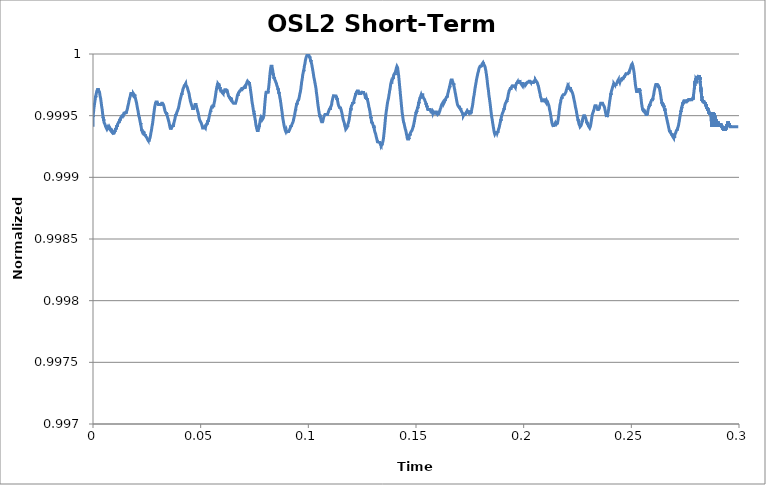
| Category | OSL2 Short-Term Stability |
|---|---|
| 0.0 | 0.999 |
| 1e-05 | 0.999 |
| 2e-05 | 0.999 |
| 3e-05 | 1 |
| 4e-05 | 0.999 |
| 5e-05 | 0.999 |
| 6e-05 | 1 |
| 7e-05 | 1 |
| 8e-05 | 1 |
| 9e-05 | 1 |
| 0.0001 | 1 |
| 0.00011 | 1 |
| 0.00012 | 1 |
| 0.00013 | 1 |
| 0.00014 | 1 |
| 0.00015 | 1 |
| 0.00016 | 1 |
| 0.00017 | 1 |
| 0.00018 | 1 |
| 0.00019 | 1 |
| 0.0002 | 1 |
| 0.00021 | 1 |
| 0.00022 | 1 |
| 0.00023 | 1 |
| 0.00024 | 1 |
| 0.00025 | 1 |
| 0.00026 | 1 |
| 0.00027 | 1 |
| 0.00028 | 1 |
| 0.00029 | 1 |
| 0.0003 | 1 |
| 0.00031 | 1 |
| 0.00032 | 1 |
| 0.00033 | 1 |
| 0.00034 | 1 |
| 0.00035 | 1 |
| 0.00036 | 1 |
| 0.00037 | 1 |
| 0.00038 | 1 |
| 0.00039 | 1 |
| 0.0004 | 1 |
| 0.00041 | 1 |
| 0.00042 | 1 |
| 0.00043 | 1 |
| 0.00044 | 1 |
| 0.00045 | 1 |
| 0.00046 | 1 |
| 0.00047 | 1 |
| 0.00048 | 1 |
| 0.00049 | 1 |
| 0.0005 | 1 |
| 0.00051 | 1 |
| 0.00052 | 1 |
| 0.00053 | 1 |
| 0.00054 | 1 |
| 0.00055 | 1 |
| 0.00056 | 1 |
| 0.00057 | 1 |
| 0.00058 | 1 |
| 0.00059 | 1 |
| 0.0006 | 1 |
| 0.00061 | 1 |
| 0.00062 | 1 |
| 0.00063 | 1 |
| 0.00064 | 1 |
| 0.00065 | 1 |
| 0.00066 | 1 |
| 0.00067 | 1 |
| 0.00068 | 1 |
| 0.00069 | 1 |
| 0.0007 | 1 |
| 0.00071 | 1 |
| 0.00072 | 1 |
| 0.00073 | 1 |
| 0.00074 | 1 |
| 0.00075 | 1 |
| 0.00076 | 1 |
| 0.00077 | 1 |
| 0.00078 | 1 |
| 0.00079 | 1 |
| 0.0008 | 1 |
| 0.00081 | 1 |
| 0.00082 | 1 |
| 0.00083 | 1 |
| 0.00084 | 1 |
| 0.00085 | 1 |
| 0.00086 | 1 |
| 0.00087 | 1 |
| 0.00088 | 1 |
| 0.00089 | 1 |
| 0.0009 | 1 |
| 0.00091 | 1 |
| 0.00092 | 1 |
| 0.00093 | 1 |
| 0.00094 | 1 |
| 0.00095 | 1 |
| 0.00096 | 1 |
| 0.00097 | 1 |
| 0.00098 | 1 |
| 0.00099 | 1 |
| 0.001 | 1 |
| 0.00101 | 1 |
| 0.00102 | 1 |
| 0.00103 | 1 |
| 0.00104 | 1 |
| 0.00105 | 1 |
| 0.00106 | 1 |
| 0.00107 | 1 |
| 0.00108 | 1 |
| 0.00109 | 1 |
| 0.0011 | 1 |
| 0.00111 | 1 |
| 0.00112 | 1 |
| 0.00113 | 1 |
| 0.00114 | 1 |
| 0.00115 | 1 |
| 0.00116 | 1 |
| 0.00117 | 1 |
| 0.00118 | 1 |
| 0.00119 | 1 |
| 0.0012 | 1 |
| 0.00121 | 1 |
| 0.00122 | 1 |
| 0.00123 | 1 |
| 0.00124 | 1 |
| 0.00125 | 1 |
| 0.00126 | 1 |
| 0.00127 | 1 |
| 0.00128 | 1 |
| 0.00129 | 1 |
| 0.0013 | 1 |
| 0.00131 | 1 |
| 0.00132 | 1 |
| 0.00133 | 1 |
| 0.00134 | 1 |
| 0.00135 | 1 |
| 0.00136 | 1 |
| 0.00137 | 1 |
| 0.00138 | 1 |
| 0.00139 | 1 |
| 0.0014 | 1 |
| 0.00141 | 1 |
| 0.00142 | 1 |
| 0.00143 | 1 |
| 0.00144 | 1 |
| 0.00145 | 1 |
| 0.00146 | 1 |
| 0.00147 | 1 |
| 0.00148 | 1 |
| 0.00149 | 1 |
| 0.0015 | 1 |
| 0.00151 | 1 |
| 0.00152 | 1 |
| 0.00153 | 1 |
| 0.00154 | 1 |
| 0.00155 | 1 |
| 0.00156 | 1 |
| 0.00157 | 1 |
| 0.00158 | 1 |
| 0.00159 | 1 |
| 0.0016 | 1 |
| 0.00161 | 1 |
| 0.00162 | 1 |
| 0.00163 | 1 |
| 0.00164 | 1 |
| 0.00165 | 1 |
| 0.00166 | 1 |
| 0.00167 | 1 |
| 0.00168 | 1 |
| 0.00169 | 1 |
| 0.0017 | 1 |
| 0.00171 | 1 |
| 0.00172 | 1 |
| 0.00173 | 1 |
| 0.00174 | 1 |
| 0.00175 | 1 |
| 0.00176 | 1 |
| 0.00177 | 1 |
| 0.00178 | 1 |
| 0.00179 | 1 |
| 0.0018 | 1 |
| 0.00181 | 1 |
| 0.00182 | 1 |
| 0.00183 | 1 |
| 0.00184 | 1 |
| 0.00185 | 1 |
| 0.00186 | 1 |
| 0.00187 | 1 |
| 0.00188 | 1 |
| 0.00189 | 1 |
| 0.0019 | 1 |
| 0.00191 | 1 |
| 0.00192 | 1 |
| 0.00193 | 1 |
| 0.00194 | 1 |
| 0.00195 | 1 |
| 0.00196 | 1 |
| 0.00197 | 1 |
| 0.00198 | 1 |
| 0.00199 | 1 |
| 0.002 | 1 |
| 0.00201 | 1 |
| 0.00202 | 1 |
| 0.00203 | 1 |
| 0.00204 | 1 |
| 0.00205 | 1 |
| 0.00206 | 1 |
| 0.00207 | 1 |
| 0.00208 | 1 |
| 0.00209 | 1 |
| 0.0021 | 1 |
| 0.00211 | 1 |
| 0.00212 | 1 |
| 0.00213 | 1 |
| 0.00214 | 1 |
| 0.00215 | 1 |
| 0.00216 | 1 |
| 0.00217 | 1 |
| 0.00218 | 1 |
| 0.00219 | 1 |
| 0.0022 | 1 |
| 0.00221 | 1 |
| 0.00222 | 1 |
| 0.00223 | 1 |
| 0.00224 | 1 |
| 0.00225 | 1 |
| 0.00226 | 1 |
| 0.00227 | 1 |
| 0.00228 | 1 |
| 0.00229 | 1 |
| 0.0023 | 1 |
| 0.00231 | 1 |
| 0.00232 | 1 |
| 0.00233 | 1 |
| 0.00234 | 1 |
| 0.00235 | 1 |
| 0.00236 | 1 |
| 0.00237 | 1 |
| 0.00238 | 1 |
| 0.00239 | 1 |
| 0.0024 | 1 |
| 0.00241 | 1 |
| 0.00242 | 1 |
| 0.00243 | 1 |
| 0.00244 | 1 |
| 0.00245 | 1 |
| 0.00246 | 1 |
| 0.00247 | 1 |
| 0.00248 | 1 |
| 0.00249 | 1 |
| 0.0025 | 1 |
| 0.00251 | 1 |
| 0.00252 | 1 |
| 0.00253 | 1 |
| 0.00254 | 1 |
| 0.00255 | 1 |
| 0.00256 | 1 |
| 0.00257 | 1 |
| 0.00258 | 1 |
| 0.00259 | 1 |
| 0.0026 | 1 |
| 0.00261 | 1 |
| 0.00262 | 1 |
| 0.00263 | 1 |
| 0.00264 | 1 |
| 0.00265 | 1 |
| 0.00266 | 1 |
| 0.00267 | 1 |
| 0.00268 | 1 |
| 0.00269 | 1 |
| 0.0027 | 1 |
| 0.00271 | 1 |
| 0.00272 | 1 |
| 0.00273 | 1 |
| 0.00274 | 1 |
| 0.00275 | 1 |
| 0.00276 | 1 |
| 0.00277 | 1 |
| 0.00278 | 1 |
| 0.00279 | 1 |
| 0.0028 | 1 |
| 0.00281 | 1 |
| 0.00282 | 1 |
| 0.00283 | 1 |
| 0.00284 | 1 |
| 0.00285 | 1 |
| 0.00286 | 1 |
| 0.00287 | 1 |
| 0.00288 | 1 |
| 0.00289 | 1 |
| 0.0029 | 1 |
| 0.00291 | 1 |
| 0.00292 | 1 |
| 0.00293 | 1 |
| 0.00294 | 1 |
| 0.00295 | 1 |
| 0.00296 | 1 |
| 0.00297 | 1 |
| 0.00298 | 1 |
| 0.00299 | 1 |
| 0.003 | 1 |
| 0.00301 | 1 |
| 0.00302 | 1 |
| 0.00303 | 1 |
| 0.00304 | 1 |
| 0.00305 | 1 |
| 0.00306 | 1 |
| 0.00307 | 1 |
| 0.00308 | 1 |
| 0.00309 | 1 |
| 0.0031 | 1 |
| 0.00311 | 1 |
| 0.00312 | 1 |
| 0.00313 | 1 |
| 0.00314 | 1 |
| 0.00315 | 1 |
| 0.00316 | 1 |
| 0.00317 | 1 |
| 0.00318 | 1 |
| 0.00319 | 1 |
| 0.0032 | 1 |
| 0.00321 | 1 |
| 0.00322 | 1 |
| 0.00323 | 1 |
| 0.00324 | 1 |
| 0.00325 | 1 |
| 0.00326 | 1 |
| 0.00327 | 1 |
| 0.00328 | 1 |
| 0.00329 | 1 |
| 0.0033 | 1 |
| 0.00331 | 1 |
| 0.00332 | 1 |
| 0.00333 | 1 |
| 0.00334 | 1 |
| 0.00335 | 1 |
| 0.00336 | 1 |
| 0.00337 | 1 |
| 0.00338 | 1 |
| 0.00339 | 1 |
| 0.0034 | 1 |
| 0.00341 | 1 |
| 0.00342 | 1 |
| 0.00343 | 1 |
| 0.00344 | 1 |
| 0.00345 | 1 |
| 0.00346 | 1 |
| 0.00347 | 1 |
| 0.00348 | 1 |
| 0.00349 | 1 |
| 0.0035 | 1 |
| 0.00351 | 1 |
| 0.00352 | 1 |
| 0.00353 | 1 |
| 0.00354 | 1 |
| 0.00355 | 1 |
| 0.00356 | 1 |
| 0.00357 | 1 |
| 0.00358 | 1 |
| 0.00359 | 1 |
| 0.0036 | 1 |
| 0.00361 | 1 |
| 0.00362 | 1 |
| 0.00363 | 1 |
| 0.00364 | 1 |
| 0.00365 | 1 |
| 0.00366 | 1 |
| 0.00367 | 1 |
| 0.00368 | 1 |
| 0.00369 | 1 |
| 0.0037 | 1 |
| 0.00371 | 1 |
| 0.00372 | 1 |
| 0.00373 | 1 |
| 0.00374 | 1 |
| 0.00375 | 1 |
| 0.00376 | 1 |
| 0.00377 | 1 |
| 0.00378 | 1 |
| 0.00379 | 1 |
| 0.0038 | 1 |
| 0.00381 | 1 |
| 0.00382 | 1 |
| 0.00383 | 1 |
| 0.00384 | 1 |
| 0.00385 | 1 |
| 0.00386 | 1 |
| 0.00387 | 1 |
| 0.00388 | 1 |
| 0.00389 | 1 |
| 0.0039 | 1 |
| 0.00391 | 1 |
| 0.00392 | 1 |
| 0.00393 | 1 |
| 0.00394 | 1 |
| 0.00395 | 1 |
| 0.00396 | 1 |
| 0.00397 | 1 |
| 0.00398 | 1 |
| 0.00399 | 1 |
| 0.004 | 1 |
| 0.00401 | 1 |
| 0.00402 | 1 |
| 0.00403 | 1 |
| 0.00404 | 1 |
| 0.00405 | 1 |
| 0.00406 | 1 |
| 0.00407 | 1 |
| 0.00408 | 1 |
| 0.00409 | 1 |
| 0.0041 | 1 |
| 0.00411 | 1 |
| 0.00412 | 1 |
| 0.00413 | 1 |
| 0.00414 | 1 |
| 0.00415 | 1 |
| 0.00416 | 1 |
| 0.00417 | 1 |
| 0.00418 | 1 |
| 0.00419 | 1 |
| 0.0042 | 1 |
| 0.00421 | 1 |
| 0.00422 | 1 |
| 0.00423 | 1 |
| 0.00424 | 1 |
| 0.00425 | 1 |
| 0.00426 | 1 |
| 0.00427 | 1 |
| 0.00428 | 1 |
| 0.00429 | 1 |
| 0.0043 | 1 |
| 0.00431 | 1 |
| 0.00432 | 1 |
| 0.00433 | 1 |
| 0.00434 | 1 |
| 0.00435 | 1 |
| 0.00436 | 1 |
| 0.00437 | 1 |
| 0.00438 | 1 |
| 0.00439 | 1 |
| 0.0044 | 1 |
| 0.00441 | 1 |
| 0.00442 | 1 |
| 0.00443 | 1 |
| 0.00444 | 1 |
| 0.00445 | 1 |
| 0.00446 | 1 |
| 0.00447 | 1 |
| 0.00448 | 1 |
| 0.00449 | 1 |
| 0.0045 | 1 |
| 0.00451 | 1 |
| 0.00452 | 1 |
| 0.00453 | 1 |
| 0.00454 | 1 |
| 0.00455 | 1 |
| 0.00456 | 1 |
| 0.00457 | 1 |
| 0.00458 | 1 |
| 0.00459 | 1 |
| 0.0046 | 1 |
| 0.00461 | 1 |
| 0.00462 | 1 |
| 0.00463 | 1 |
| 0.00464 | 1 |
| 0.00465 | 1 |
| 0.00466 | 1 |
| 0.00467 | 1 |
| 0.00468 | 1 |
| 0.00469 | 1 |
| 0.0047 | 1 |
| 0.00471 | 0.999 |
| 0.00472 | 0.999 |
| 0.00473 | 0.999 |
| 0.00474 | 0.999 |
| 0.00475 | 0.999 |
| 0.00476 | 0.999 |
| 0.00477 | 0.999 |
| 0.00478 | 0.999 |
| 0.00479 | 0.999 |
| 0.0048 | 0.999 |
| 0.00481 | 0.999 |
| 0.00482 | 0.999 |
| 0.00483 | 0.999 |
| 0.00484 | 0.999 |
| 0.00485 | 0.999 |
| 0.00486 | 0.999 |
| 0.00487 | 0.999 |
| 0.00488 | 0.999 |
| 0.00489 | 0.999 |
| 0.0049 | 0.999 |
| 0.00491 | 0.999 |
| 0.00492 | 0.999 |
| 0.00493 | 0.999 |
| 0.00494 | 0.999 |
| 0.00495 | 0.999 |
| 0.00496 | 0.999 |
| 0.00497 | 0.999 |
| 0.00498 | 0.999 |
| 0.00499 | 0.999 |
| 0.005 | 0.999 |
| 0.00501 | 0.999 |
| 0.00502 | 0.999 |
| 0.00503 | 0.999 |
| 0.00504 | 0.999 |
| 0.00505 | 0.999 |
| 0.00506 | 0.999 |
| 0.00507 | 0.999 |
| 0.00508 | 0.999 |
| 0.00509 | 0.999 |
| 0.0051 | 0.999 |
| 0.00511 | 0.999 |
| 0.00512 | 0.999 |
| 0.00513 | 0.999 |
| 0.00514 | 0.999 |
| 0.00515 | 0.999 |
| 0.00516 | 0.999 |
| 0.00517 | 0.999 |
| 0.00518 | 0.999 |
| 0.00519 | 0.999 |
| 0.0052 | 0.999 |
| 0.00521 | 0.999 |
| 0.00522 | 0.999 |
| 0.00523 | 0.999 |
| 0.00524 | 0.999 |
| 0.00525 | 0.999 |
| 0.00526 | 0.999 |
| 0.00527 | 0.999 |
| 0.00528 | 0.999 |
| 0.00529 | 0.999 |
| 0.0053 | 0.999 |
| 0.00531 | 0.999 |
| 0.00532 | 0.999 |
| 0.00533 | 0.999 |
| 0.00534 | 0.999 |
| 0.00535 | 0.999 |
| 0.00536 | 0.999 |
| 0.00537 | 0.999 |
| 0.00538 | 0.999 |
| 0.00539 | 0.999 |
| 0.0054 | 0.999 |
| 0.00541 | 0.999 |
| 0.00542 | 0.999 |
| 0.00543 | 0.999 |
| 0.00544 | 0.999 |
| 0.00545 | 0.999 |
| 0.00546 | 0.999 |
| 0.00547 | 0.999 |
| 0.00548 | 0.999 |
| 0.00549 | 0.999 |
| 0.0055 | 0.999 |
| 0.00551 | 0.999 |
| 0.00552 | 0.999 |
| 0.00553 | 0.999 |
| 0.00554 | 0.999 |
| 0.00555 | 0.999 |
| 0.00556 | 0.999 |
| 0.00557 | 0.999 |
| 0.00558 | 0.999 |
| 0.00559 | 0.999 |
| 0.0056 | 0.999 |
| 0.00561 | 0.999 |
| 0.00562 | 0.999 |
| 0.00563 | 0.999 |
| 0.00564 | 0.999 |
| 0.00565 | 0.999 |
| 0.00566 | 0.999 |
| 0.00567 | 0.999 |
| 0.00568 | 0.999 |
| 0.00569 | 0.999 |
| 0.0057 | 0.999 |
| 0.00571 | 0.999 |
| 0.00572 | 0.999 |
| 0.00573 | 0.999 |
| 0.00574 | 0.999 |
| 0.00575 | 0.999 |
| 0.00576 | 0.999 |
| 0.00577 | 0.999 |
| 0.00578 | 0.999 |
| 0.00579 | 0.999 |
| 0.0058 | 0.999 |
| 0.00581 | 0.999 |
| 0.00582 | 0.999 |
| 0.00583 | 0.999 |
| 0.00584 | 0.999 |
| 0.00585 | 0.999 |
| 0.00586 | 0.999 |
| 0.00587 | 0.999 |
| 0.00588 | 0.999 |
| 0.00589 | 0.999 |
| 0.0059 | 0.999 |
| 0.00591 | 0.999 |
| 0.00592 | 0.999 |
| 0.00593 | 0.999 |
| 0.00594 | 0.999 |
| 0.00595 | 0.999 |
| 0.00596 | 0.999 |
| 0.00597 | 0.999 |
| 0.00598 | 0.999 |
| 0.00599 | 0.999 |
| 0.006 | 0.999 |
| 0.00601 | 0.999 |
| 0.00602 | 0.999 |
| 0.00603 | 0.999 |
| 0.00604 | 0.999 |
| 0.00605 | 0.999 |
| 0.00606 | 0.999 |
| 0.00607 | 0.999 |
| 0.00608 | 0.999 |
| 0.00609 | 0.999 |
| 0.0061 | 0.999 |
| 0.00611 | 0.999 |
| 0.00612 | 0.999 |
| 0.00613 | 0.999 |
| 0.00614 | 0.999 |
| 0.00615 | 0.999 |
| 0.00616 | 0.999 |
| 0.00617 | 0.999 |
| 0.00618 | 0.999 |
| 0.00619 | 0.999 |
| 0.0062 | 0.999 |
| 0.00621 | 0.999 |
| 0.00622 | 0.999 |
| 0.00623 | 0.999 |
| 0.00624 | 0.999 |
| 0.00625 | 0.999 |
| 0.00626 | 0.999 |
| 0.00627 | 0.999 |
| 0.00628 | 0.999 |
| 0.00629 | 0.999 |
| 0.0063 | 0.999 |
| 0.00631 | 0.999 |
| 0.00632 | 0.999 |
| 0.00633 | 0.999 |
| 0.00634 | 0.999 |
| 0.00635 | 0.999 |
| 0.00636 | 0.999 |
| 0.00637 | 0.999 |
| 0.00638 | 0.999 |
| 0.00639 | 0.999 |
| 0.0064 | 0.999 |
| 0.00641 | 0.999 |
| 0.00642 | 0.999 |
| 0.00643 | 0.999 |
| 0.00644 | 0.999 |
| 0.00645 | 0.999 |
| 0.00646 | 0.999 |
| 0.00647 | 0.999 |
| 0.00648 | 0.999 |
| 0.00649 | 0.999 |
| 0.0065 | 0.999 |
| 0.00651 | 0.999 |
| 0.00652 | 0.999 |
| 0.00653 | 0.999 |
| 0.00654 | 0.999 |
| 0.00655 | 0.999 |
| 0.00656 | 0.999 |
| 0.00657 | 0.999 |
| 0.00658 | 0.999 |
| 0.00659 | 0.999 |
| 0.0066 | 0.999 |
| 0.00661 | 0.999 |
| 0.00662 | 0.999 |
| 0.00663 | 0.999 |
| 0.00664 | 0.999 |
| 0.00665 | 0.999 |
| 0.00666 | 0.999 |
| 0.00667 | 0.999 |
| 0.00668 | 0.999 |
| 0.00669 | 0.999 |
| 0.0067 | 0.999 |
| 0.00671 | 0.999 |
| 0.00672 | 0.999 |
| 0.00673 | 0.999 |
| 0.00674 | 0.999 |
| 0.00675 | 0.999 |
| 0.00676 | 0.999 |
| 0.00677 | 0.999 |
| 0.00678 | 0.999 |
| 0.00679 | 0.999 |
| 0.0068 | 0.999 |
| 0.00681 | 0.999 |
| 0.00682 | 0.999 |
| 0.00683 | 0.999 |
| 0.00684 | 0.999 |
| 0.00685 | 0.999 |
| 0.00686 | 0.999 |
| 0.00687 | 0.999 |
| 0.00688 | 0.999 |
| 0.00689 | 0.999 |
| 0.0069 | 0.999 |
| 0.00691 | 0.999 |
| 0.00692 | 0.999 |
| 0.00693 | 0.999 |
| 0.00694 | 0.999 |
| 0.00695 | 0.999 |
| 0.00696 | 0.999 |
| 0.00697 | 0.999 |
| 0.00698 | 0.999 |
| 0.00699 | 0.999 |
| 0.007 | 0.999 |
| 0.00701 | 0.999 |
| 0.00702 | 0.999 |
| 0.00703 | 0.999 |
| 0.00704 | 0.999 |
| 0.00705 | 0.999 |
| 0.00706 | 0.999 |
| 0.00707 | 0.999 |
| 0.00708 | 0.999 |
| 0.00709 | 0.999 |
| 0.0071 | 0.999 |
| 0.00711 | 0.999 |
| 0.00712 | 0.999 |
| 0.00713 | 0.999 |
| 0.00714 | 0.999 |
| 0.00715 | 0.999 |
| 0.00716 | 0.999 |
| 0.00717 | 0.999 |
| 0.00718 | 0.999 |
| 0.00719 | 0.999 |
| 0.0072 | 0.999 |
| 0.00721 | 0.999 |
| 0.00722 | 0.999 |
| 0.00723 | 0.999 |
| 0.00724 | 0.999 |
| 0.00725 | 0.999 |
| 0.00726 | 0.999 |
| 0.00727 | 0.999 |
| 0.00728 | 0.999 |
| 0.00729 | 0.999 |
| 0.0073 | 0.999 |
| 0.00731 | 0.999 |
| 0.00732 | 0.999 |
| 0.00733 | 0.999 |
| 0.00734 | 0.999 |
| 0.00735 | 0.999 |
| 0.00736 | 0.999 |
| 0.00737 | 0.999 |
| 0.00738 | 0.999 |
| 0.00739 | 0.999 |
| 0.0074 | 0.999 |
| 0.00741 | 0.999 |
| 0.00742 | 0.999 |
| 0.00743 | 0.999 |
| 0.00744 | 0.999 |
| 0.00745 | 0.999 |
| 0.00746 | 0.999 |
| 0.00747 | 0.999 |
| 0.00748 | 0.999 |
| 0.00749 | 0.999 |
| 0.0075 | 0.999 |
| 0.00751 | 0.999 |
| 0.00752 | 0.999 |
| 0.00753 | 0.999 |
| 0.00754 | 0.999 |
| 0.00755 | 0.999 |
| 0.00756 | 0.999 |
| 0.00757 | 0.999 |
| 0.00758 | 0.999 |
| 0.00759 | 0.999 |
| 0.0076 | 0.999 |
| 0.00761 | 0.999 |
| 0.00762 | 0.999 |
| 0.00763 | 0.999 |
| 0.00764 | 0.999 |
| 0.00765 | 0.999 |
| 0.00766 | 0.999 |
| 0.00767 | 0.999 |
| 0.00768 | 0.999 |
| 0.00769 | 0.999 |
| 0.0077 | 0.999 |
| 0.00771 | 0.999 |
| 0.00772 | 0.999 |
| 0.00773 | 0.999 |
| 0.00774 | 0.999 |
| 0.00775 | 0.999 |
| 0.00776 | 0.999 |
| 0.00777 | 0.999 |
| 0.00778 | 0.999 |
| 0.00779 | 0.999 |
| 0.0078 | 0.999 |
| 0.00781 | 0.999 |
| 0.00782 | 0.999 |
| 0.00783 | 0.999 |
| 0.00784 | 0.999 |
| 0.00785 | 0.999 |
| 0.00786 | 0.999 |
| 0.00787 | 0.999 |
| 0.00788 | 0.999 |
| 0.00789 | 0.999 |
| 0.0079 | 0.999 |
| 0.00791 | 0.999 |
| 0.00792 | 0.999 |
| 0.00793 | 0.999 |
| 0.00794 | 0.999 |
| 0.00795 | 0.999 |
| 0.00796 | 0.999 |
| 0.00797 | 0.999 |
| 0.00798 | 0.999 |
| 0.00799 | 0.999 |
| 0.008 | 0.999 |
| 0.00801 | 0.999 |
| 0.00802 | 0.999 |
| 0.00803 | 0.999 |
| 0.00804 | 0.999 |
| 0.00805 | 0.999 |
| 0.00806 | 0.999 |
| 0.00807 | 0.999 |
| 0.00808 | 0.999 |
| 0.00809 | 0.999 |
| 0.0081 | 0.999 |
| 0.00811 | 0.999 |
| 0.00812 | 0.999 |
| 0.00813 | 0.999 |
| 0.00814 | 0.999 |
| 0.00815 | 0.999 |
| 0.00816 | 0.999 |
| 0.00817 | 0.999 |
| 0.00818 | 0.999 |
| 0.00819 | 0.999 |
| 0.0082 | 0.999 |
| 0.00821 | 0.999 |
| 0.00822 | 0.999 |
| 0.00823 | 0.999 |
| 0.00824 | 0.999 |
| 0.00825 | 0.999 |
| 0.00826 | 0.999 |
| 0.00827 | 0.999 |
| 0.00828 | 0.999 |
| 0.00829 | 0.999 |
| 0.0083 | 0.999 |
| 0.00831 | 0.999 |
| 0.00832 | 0.999 |
| 0.00833 | 0.999 |
| 0.00834 | 0.999 |
| 0.00835 | 0.999 |
| 0.00836 | 0.999 |
| 0.00837 | 0.999 |
| 0.00838 | 0.999 |
| 0.00839 | 0.999 |
| 0.0084 | 0.999 |
| 0.00841 | 0.999 |
| 0.00842 | 0.999 |
| 0.00843 | 0.999 |
| 0.00844 | 0.999 |
| 0.00845 | 0.999 |
| 0.00846 | 0.999 |
| 0.00847 | 0.999 |
| 0.00848 | 0.999 |
| 0.00849 | 0.999 |
| 0.0085 | 0.999 |
| 0.00851 | 0.999 |
| 0.00852 | 0.999 |
| 0.00853 | 0.999 |
| 0.00854 | 0.999 |
| 0.00855 | 0.999 |
| 0.00856 | 0.999 |
| 0.00857 | 0.999 |
| 0.00858 | 0.999 |
| 0.00859 | 0.999 |
| 0.0086 | 0.999 |
| 0.00861 | 0.999 |
| 0.00862 | 0.999 |
| 0.00863 | 0.999 |
| 0.00864 | 0.999 |
| 0.00865 | 0.999 |
| 0.00866 | 0.999 |
| 0.00867 | 0.999 |
| 0.00868 | 0.999 |
| 0.00869 | 0.999 |
| 0.0087 | 0.999 |
| 0.00871 | 0.999 |
| 0.00872 | 0.999 |
| 0.00873 | 0.999 |
| 0.00874 | 0.999 |
| 0.00875 | 0.999 |
| 0.00876 | 0.999 |
| 0.00877 | 0.999 |
| 0.00878 | 0.999 |
| 0.00879 | 0.999 |
| 0.0088 | 0.999 |
| 0.00881 | 0.999 |
| 0.00882 | 0.999 |
| 0.00883 | 0.999 |
| 0.00884 | 0.999 |
| 0.00885 | 0.999 |
| 0.00886 | 0.999 |
| 0.00887 | 0.999 |
| 0.00888 | 0.999 |
| 0.00889 | 0.999 |
| 0.0089 | 0.999 |
| 0.00891 | 0.999 |
| 0.00892 | 0.999 |
| 0.00893 | 0.999 |
| 0.00894 | 0.999 |
| 0.00895 | 0.999 |
| 0.00896 | 0.999 |
| 0.00897 | 0.999 |
| 0.00898 | 0.999 |
| 0.00899 | 0.999 |
| 0.009 | 0.999 |
| 0.00901 | 0.999 |
| 0.00902 | 0.999 |
| 0.00903 | 0.999 |
| 0.00904 | 0.999 |
| 0.00905 | 0.999 |
| 0.00906 | 0.999 |
| 0.00907 | 0.999 |
| 0.00908 | 0.999 |
| 0.00909 | 0.999 |
| 0.0091 | 0.999 |
| 0.00911 | 0.999 |
| 0.00912 | 0.999 |
| 0.00913 | 0.999 |
| 0.00914 | 0.999 |
| 0.00915 | 0.999 |
| 0.00916 | 0.999 |
| 0.00917 | 0.999 |
| 0.00918 | 0.999 |
| 0.00919 | 0.999 |
| 0.0092 | 0.999 |
| 0.00921 | 0.999 |
| 0.00922 | 0.999 |
| 0.00923 | 0.999 |
| 0.00924 | 0.999 |
| 0.00925 | 0.999 |
| 0.00926 | 0.999 |
| 0.00927 | 0.999 |
| 0.00928 | 0.999 |
| 0.00929 | 0.999 |
| 0.0093 | 0.999 |
| 0.00931 | 0.999 |
| 0.00932 | 0.999 |
| 0.00933 | 0.999 |
| 0.00934 | 0.999 |
| 0.00935 | 0.999 |
| 0.00936 | 0.999 |
| 0.00937 | 0.999 |
| 0.00938 | 0.999 |
| 0.00939 | 0.999 |
| 0.0094 | 0.999 |
| 0.00941 | 0.999 |
| 0.00942 | 0.999 |
| 0.00943 | 0.999 |
| 0.00944 | 0.999 |
| 0.00945 | 0.999 |
| 0.00946 | 0.999 |
| 0.00947 | 0.999 |
| 0.00948 | 0.999 |
| 0.00949 | 0.999 |
| 0.0095 | 0.999 |
| 0.00951 | 0.999 |
| 0.00952 | 0.999 |
| 0.00953 | 0.999 |
| 0.00954 | 0.999 |
| 0.00955 | 0.999 |
| 0.00956 | 0.999 |
| 0.00957 | 0.999 |
| 0.00958 | 0.999 |
| 0.00959 | 0.999 |
| 0.0096 | 0.999 |
| 0.00961 | 0.999 |
| 0.00962 | 0.999 |
| 0.00963 | 0.999 |
| 0.00964 | 0.999 |
| 0.00965 | 0.999 |
| 0.00966 | 0.999 |
| 0.00967 | 0.999 |
| 0.00968 | 0.999 |
| 0.00969 | 0.999 |
| 0.0097 | 0.999 |
| 0.00971 | 0.999 |
| 0.00972 | 0.999 |
| 0.00973 | 0.999 |
| 0.00974 | 0.999 |
| 0.00975 | 0.999 |
| 0.00976 | 0.999 |
| 0.00977 | 0.999 |
| 0.00978 | 0.999 |
| 0.00979 | 0.999 |
| 0.0098 | 0.999 |
| 0.00981 | 0.999 |
| 0.00982 | 0.999 |
| 0.00983 | 0.999 |
| 0.00984 | 0.999 |
| 0.00985 | 0.999 |
| 0.00986 | 0.999 |
| 0.00987 | 0.999 |
| 0.00988 | 0.999 |
| 0.00989 | 0.999 |
| 0.0099 | 0.999 |
| 0.00991 | 0.999 |
| 0.00992 | 0.999 |
| 0.00993 | 0.999 |
| 0.00994 | 0.999 |
| 0.00995 | 0.999 |
| 0.00996 | 0.999 |
| 0.00997 | 0.999 |
| 0.00998 | 0.999 |
| 0.00999 | 0.999 |
| 0.01 | 0.999 |
| 0.01001 | 0.999 |
| 0.01002 | 0.999 |
| 0.01003 | 0.999 |
| 0.01004 | 0.999 |
| 0.01005 | 0.999 |
| 0.01006 | 0.999 |
| 0.01007 | 0.999 |
| 0.01008 | 0.999 |
| 0.01009 | 0.999 |
| 0.0101 | 0.999 |
| 0.01011 | 0.999 |
| 0.01012 | 0.999 |
| 0.01013 | 0.999 |
| 0.01014 | 0.999 |
| 0.01015 | 0.999 |
| 0.01016 | 0.999 |
| 0.01017 | 0.999 |
| 0.01018 | 0.999 |
| 0.01019 | 0.999 |
| 0.0102 | 0.999 |
| 0.01021 | 0.999 |
| 0.01022 | 0.999 |
| 0.01023 | 0.999 |
| 0.01024 | 0.999 |
| 0.01025 | 0.999 |
| 0.01026 | 0.999 |
| 0.01027 | 0.999 |
| 0.01028 | 0.999 |
| 0.01029 | 0.999 |
| 0.0103 | 0.999 |
| 0.01031 | 0.999 |
| 0.01032 | 0.999 |
| 0.01033 | 0.999 |
| 0.01034 | 0.999 |
| 0.01035 | 0.999 |
| 0.01036 | 0.999 |
| 0.01037 | 0.999 |
| 0.01038 | 0.999 |
| 0.01039 | 0.999 |
| 0.0104 | 0.999 |
| 0.01041 | 0.999 |
| 0.01042 | 0.999 |
| 0.01043 | 0.999 |
| 0.01044 | 0.999 |
| 0.01045 | 0.999 |
| 0.01046 | 0.999 |
| 0.01047 | 0.999 |
| 0.01048 | 0.999 |
| 0.01049 | 0.999 |
| 0.0105 | 0.999 |
| 0.01051 | 0.999 |
| 0.01052 | 0.999 |
| 0.01053 | 0.999 |
| 0.01054 | 0.999 |
| 0.01055 | 0.999 |
| 0.01056 | 0.999 |
| 0.01057 | 0.999 |
| 0.01058 | 0.999 |
| 0.01059 | 0.999 |
| 0.0106 | 0.999 |
| 0.01061 | 0.999 |
| 0.01062 | 0.999 |
| 0.01063 | 0.999 |
| 0.01064 | 0.999 |
| 0.01065 | 0.999 |
| 0.01066 | 0.999 |
| 0.01067 | 0.999 |
| 0.01068 | 0.999 |
| 0.01069 | 0.999 |
| 0.0107 | 0.999 |
| 0.01071 | 0.999 |
| 0.01072 | 0.999 |
| 0.01073 | 0.999 |
| 0.01074 | 0.999 |
| 0.01075 | 0.999 |
| 0.01076 | 0.999 |
| 0.01077 | 0.999 |
| 0.01078 | 0.999 |
| 0.01079 | 0.999 |
| 0.0108 | 0.999 |
| 0.01081 | 0.999 |
| 0.01082 | 0.999 |
| 0.01083 | 0.999 |
| 0.01084 | 0.999 |
| 0.01085 | 0.999 |
| 0.01086 | 0.999 |
| 0.01087 | 0.999 |
| 0.01088 | 0.999 |
| 0.01089 | 0.999 |
| 0.0109 | 0.999 |
| 0.01091 | 0.999 |
| 0.01092 | 0.999 |
| 0.01093 | 0.999 |
| 0.01094 | 0.999 |
| 0.01095 | 0.999 |
| 0.01096 | 0.999 |
| 0.01097 | 0.999 |
| 0.01098 | 0.999 |
| 0.01099 | 0.999 |
| 0.011 | 0.999 |
| 0.01101 | 0.999 |
| 0.01102 | 0.999 |
| 0.01103 | 0.999 |
| 0.01104 | 0.999 |
| 0.01105 | 0.999 |
| 0.01106 | 0.999 |
| 0.01107 | 0.999 |
| 0.01108 | 0.999 |
| 0.01109 | 0.999 |
| 0.0111 | 0.999 |
| 0.01111 | 0.999 |
| 0.01112 | 0.999 |
| 0.01113 | 0.999 |
| 0.01114 | 0.999 |
| 0.01115 | 0.999 |
| 0.01116 | 0.999 |
| 0.01117 | 0.999 |
| 0.01118 | 0.999 |
| 0.01119 | 0.999 |
| 0.0112 | 0.999 |
| 0.01121 | 0.999 |
| 0.01122 | 0.999 |
| 0.01123 | 0.999 |
| 0.01124 | 0.999 |
| 0.01125 | 0.999 |
| 0.01126 | 0.999 |
| 0.01127 | 0.999 |
| 0.01128 | 0.999 |
| 0.01129 | 0.999 |
| 0.0113 | 0.999 |
| 0.01131 | 0.999 |
| 0.01132 | 0.999 |
| 0.01133 | 0.999 |
| 0.01134 | 0.999 |
| 0.01135 | 0.999 |
| 0.01136 | 0.999 |
| 0.01137 | 0.999 |
| 0.01138 | 0.999 |
| 0.01139 | 0.999 |
| 0.0114 | 0.999 |
| 0.01141 | 0.999 |
| 0.01142 | 0.999 |
| 0.01143 | 0.999 |
| 0.01144 | 0.999 |
| 0.01145 | 0.999 |
| 0.01146 | 0.999 |
| 0.01147 | 0.999 |
| 0.01148 | 0.999 |
| 0.01149 | 0.999 |
| 0.0115 | 0.999 |
| 0.01151 | 0.999 |
| 0.01152 | 0.999 |
| 0.01153 | 0.999 |
| 0.01154 | 0.999 |
| 0.01155 | 0.999 |
| 0.01156 | 0.999 |
| 0.01157 | 0.999 |
| 0.01158 | 0.999 |
| 0.01159 | 0.999 |
| 0.0116 | 0.999 |
| 0.01161 | 0.999 |
| 0.01162 | 0.999 |
| 0.01163 | 0.999 |
| 0.01164 | 0.999 |
| 0.01165 | 0.999 |
| 0.01166 | 0.999 |
| 0.01167 | 0.999 |
| 0.01168 | 0.999 |
| 0.01169 | 0.999 |
| 0.0117 | 0.999 |
| 0.01171 | 0.999 |
| 0.01172 | 0.999 |
| 0.01173 | 0.999 |
| 0.01174 | 0.999 |
| 0.01175 | 0.999 |
| 0.01176 | 0.999 |
| 0.01177 | 0.999 |
| 0.01178 | 0.999 |
| 0.01179 | 0.999 |
| 0.0118 | 0.999 |
| 0.01181 | 0.999 |
| 0.01182 | 0.999 |
| 0.01183 | 0.999 |
| 0.01184 | 0.999 |
| 0.01185 | 0.999 |
| 0.01186 | 0.999 |
| 0.01187 | 0.999 |
| 0.01188 | 0.999 |
| 0.01189 | 0.999 |
| 0.0119 | 0.999 |
| 0.01191 | 0.999 |
| 0.01192 | 0.999 |
| 0.01193 | 0.999 |
| 0.01194 | 0.999 |
| 0.01195 | 0.999 |
| 0.01196 | 0.999 |
| 0.01197 | 0.999 |
| 0.01198 | 0.999 |
| 0.01199 | 0.999 |
| 0.012 | 0.999 |
| 0.01201 | 0.999 |
| 0.01202 | 0.999 |
| 0.01203 | 0.999 |
| 0.01204 | 0.999 |
| 0.01205 | 0.999 |
| 0.01206 | 0.999 |
| 0.01207 | 0.999 |
| 0.01208 | 0.999 |
| 0.01209 | 0.999 |
| 0.0121 | 0.999 |
| 0.01211 | 0.999 |
| 0.01212 | 0.999 |
| 0.01213 | 0.999 |
| 0.01214 | 0.999 |
| 0.01215 | 0.999 |
| 0.01216 | 0.999 |
| 0.01217 | 0.999 |
| 0.01218 | 0.999 |
| 0.01219 | 0.999 |
| 0.0122 | 0.999 |
| 0.01221 | 0.999 |
| 0.01222 | 0.999 |
| 0.01223 | 0.999 |
| 0.01224 | 0.999 |
| 0.01225 | 0.999 |
| 0.01226 | 0.999 |
| 0.01227 | 0.999 |
| 0.01228 | 0.999 |
| 0.01229 | 0.999 |
| 0.0123 | 0.999 |
| 0.01231 | 0.999 |
| 0.01232 | 0.999 |
| 0.01233 | 0.999 |
| 0.01234 | 0.999 |
| 0.01235 | 0.999 |
| 0.01236 | 0.999 |
| 0.01237 | 0.999 |
| 0.01238 | 0.999 |
| 0.01239 | 0.999 |
| 0.0124 | 0.999 |
| 0.01241 | 0.999 |
| 0.01242 | 0.999 |
| 0.01243 | 0.999 |
| 0.01244 | 0.999 |
| 0.01245 | 0.999 |
| 0.01246 | 0.999 |
| 0.01247 | 0.999 |
| 0.01248 | 0.999 |
| 0.01249 | 0.999 |
| 0.0125 | 0.999 |
| 0.01251 | 0.999 |
| 0.01252 | 0.999 |
| 0.01253 | 0.999 |
| 0.01254 | 0.999 |
| 0.01255 | 0.999 |
| 0.01256 | 0.999 |
| 0.01257 | 0.999 |
| 0.01258 | 0.999 |
| 0.01259 | 0.999 |
| 0.0126 | 0.999 |
| 0.01261 | 0.999 |
| 0.01262 | 0.999 |
| 0.01263 | 0.999 |
| 0.01264 | 0.999 |
| 0.01265 | 0.999 |
| 0.01266 | 0.999 |
| 0.01267 | 0.999 |
| 0.01268 | 0.999 |
| 0.01269 | 0.999 |
| 0.0127 | 0.999 |
| 0.01271 | 0.999 |
| 0.01272 | 0.999 |
| 0.01273 | 0.999 |
| 0.01274 | 0.999 |
| 0.01275 | 0.999 |
| 0.01276 | 0.999 |
| 0.01277 | 0.999 |
| 0.01278 | 0.999 |
| 0.01279 | 0.999 |
| 0.0128 | 0.999 |
| 0.01281 | 0.999 |
| 0.01282 | 0.999 |
| 0.01283 | 0.999 |
| 0.01284 | 0.999 |
| 0.01285 | 0.999 |
| 0.01286 | 0.999 |
| 0.01287 | 0.999 |
| 0.01288 | 0.999 |
| 0.01289 | 0.999 |
| 0.0129 | 0.999 |
| 0.01291 | 0.999 |
| 0.01292 | 0.999 |
| 0.01293 | 0.999 |
| 0.01294 | 0.999 |
| 0.01295 | 0.999 |
| 0.01296 | 0.999 |
| 0.01297 | 0.999 |
| 0.01298 | 0.999 |
| 0.01299 | 0.999 |
| 0.013 | 0.999 |
| 0.01301 | 0.999 |
| 0.01302 | 0.999 |
| 0.01303 | 0.999 |
| 0.01304 | 0.999 |
| 0.01305 | 0.999 |
| 0.01306 | 0.999 |
| 0.01307 | 0.999 |
| 0.01308 | 0.999 |
| 0.01309 | 0.999 |
| 0.0131 | 0.999 |
| 0.01311 | 0.999 |
| 0.01312 | 0.999 |
| 0.01313 | 0.999 |
| 0.01314 | 0.999 |
| 0.01315 | 0.999 |
| 0.01316 | 0.999 |
| 0.01317 | 0.999 |
| 0.01318 | 0.999 |
| 0.01319 | 0.999 |
| 0.0132 | 0.999 |
| 0.01321 | 0.999 |
| 0.01322 | 0.999 |
| 0.01323 | 0.999 |
| 0.01324 | 0.999 |
| 0.01325 | 0.999 |
| 0.01326 | 0.999 |
| 0.01327 | 0.999 |
| 0.01328 | 0.999 |
| 0.01329 | 0.999 |
| 0.0133 | 0.999 |
| 0.01331 | 0.999 |
| 0.01332 | 0.999 |
| 0.01333 | 0.999 |
| 0.01334 | 0.999 |
| 0.01335 | 0.999 |
| 0.01336 | 0.999 |
| 0.01337 | 0.999 |
| 0.01338 | 0.999 |
| 0.01339 | 0.999 |
| 0.0134 | 0.999 |
| 0.01341 | 0.999 |
| 0.01342 | 0.999 |
| 0.01343 | 0.999 |
| 0.01344 | 0.999 |
| 0.01345 | 0.999 |
| 0.01346 | 0.999 |
| 0.01347 | 0.999 |
| 0.01348 | 0.999 |
| 0.01349 | 0.999 |
| 0.0135 | 0.999 |
| 0.01351 | 0.999 |
| 0.01352 | 0.999 |
| 0.01353 | 0.999 |
| 0.01354 | 0.999 |
| 0.01355 | 0.999 |
| 0.01356 | 0.999 |
| 0.01357 | 0.999 |
| 0.01358 | 0.999 |
| 0.01359 | 0.999 |
| 0.0136 | 0.999 |
| 0.01361 | 1 |
| 0.01362 | 1 |
| 0.01363 | 1 |
| 0.01364 | 1 |
| 0.01365 | 1 |
| 0.01366 | 1 |
| 0.01367 | 1 |
| 0.01368 | 1 |
| 0.01369 | 1 |
| 0.0137 | 1 |
| 0.01371 | 1 |
| 0.01372 | 1 |
| 0.01373 | 1 |
| 0.01374 | 1 |
| 0.01375 | 1 |
| 0.01376 | 1 |
| 0.01377 | 1 |
| 0.01378 | 1 |
| 0.01379 | 1 |
| 0.0138 | 1 |
| 0.01381 | 1 |
| 0.01382 | 1 |
| 0.01383 | 1 |
| 0.01384 | 1 |
| 0.01385 | 1 |
| 0.01386 | 1 |
| 0.01387 | 1 |
| 0.01388 | 1 |
| 0.01389 | 1 |
| 0.0139 | 1 |
| 0.01391 | 1 |
| 0.01392 | 1 |
| 0.01393 | 1 |
| 0.01394 | 1 |
| 0.01395 | 1 |
| 0.01396 | 1 |
| 0.01397 | 1 |
| 0.01398 | 1 |
| 0.01399 | 1 |
| 0.014 | 1 |
| 0.01401 | 1 |
| 0.01402 | 1 |
| 0.01403 | 1 |
| 0.01404 | 1 |
| 0.01405 | 1 |
| 0.01406 | 1 |
| 0.01407 | 1 |
| 0.01408 | 1 |
| 0.01409 | 1 |
| 0.0141 | 1 |
| 0.01411 | 1 |
| 0.01412 | 1 |
| 0.01413 | 1 |
| 0.01414 | 1 |
| 0.01415 | 1 |
| 0.01416 | 1 |
| 0.01417 | 1 |
| 0.01418 | 1 |
| 0.01419 | 1 |
| 0.0142 | 1 |
| 0.01421 | 1 |
| 0.01422 | 1 |
| 0.01423 | 1 |
| 0.01424 | 1 |
| 0.01425 | 1 |
| 0.01426 | 1 |
| 0.01427 | 1 |
| 0.01428 | 1 |
| 0.01429 | 1 |
| 0.0143 | 1 |
| 0.01431 | 1 |
| 0.01432 | 1 |
| 0.01433 | 1 |
| 0.01434 | 1 |
| 0.01435 | 1 |
| 0.01436 | 1 |
| 0.01437 | 1 |
| 0.01438 | 1 |
| 0.01439 | 1 |
| 0.0144 | 1 |
| 0.01441 | 1 |
| 0.01442 | 1 |
| 0.01443 | 1 |
| 0.01444 | 1 |
| 0.01445 | 1 |
| 0.01446 | 1 |
| 0.01447 | 1 |
| 0.01448 | 1 |
| 0.01449 | 1 |
| 0.0145 | 1 |
| 0.01451 | 1 |
| 0.01452 | 1 |
| 0.01453 | 1 |
| 0.01454 | 1 |
| 0.01455 | 1 |
| 0.01456 | 1 |
| 0.01457 | 1 |
| 0.01458 | 1 |
| 0.01459 | 1 |
| 0.0146 | 1 |
| 0.01461 | 1 |
| 0.01462 | 1 |
| 0.01463 | 1 |
| 0.01464 | 1 |
| 0.01465 | 1 |
| 0.01466 | 1 |
| 0.01467 | 1 |
| 0.01468 | 1 |
| 0.01469 | 1 |
| 0.0147 | 1 |
| 0.01471 | 1 |
| 0.01472 | 1 |
| 0.01473 | 1 |
| 0.01474 | 1 |
| 0.01475 | 1 |
| 0.01476 | 1 |
| 0.01477 | 1 |
| 0.01478 | 1 |
| 0.01479 | 1 |
| 0.0148 | 1 |
| 0.01481 | 1 |
| 0.01482 | 1 |
| 0.01483 | 1 |
| 0.01484 | 1 |
| 0.01485 | 1 |
| 0.01486 | 1 |
| 0.01487 | 1 |
| 0.01488 | 1 |
| 0.01489 | 1 |
| 0.0149 | 1 |
| 0.01491 | 1 |
| 0.01492 | 1 |
| 0.01493 | 1 |
| 0.01494 | 1 |
| 0.01495 | 1 |
| 0.01496 | 1 |
| 0.01497 | 1 |
| 0.01498 | 1 |
| 0.01499 | 1 |
| 0.015 | 1 |
| 0.01501 | 1 |
| 0.01502 | 1 |
| 0.01503 | 1 |
| 0.01504 | 1 |
| 0.01505 | 1 |
| 0.01506 | 1 |
| 0.01507 | 1 |
| 0.01508 | 1 |
| 0.01509 | 1 |
| 0.0151 | 1 |
| 0.01511 | 1 |
| 0.01512 | 1 |
| 0.01513 | 1 |
| 0.01514 | 1 |
| 0.01515 | 1 |
| 0.01516 | 1 |
| 0.01517 | 1 |
| 0.01518 | 1 |
| 0.01519 | 1 |
| 0.0152 | 1 |
| 0.01521 | 1 |
| 0.01522 | 1 |
| 0.01523 | 1 |
| 0.01524 | 1 |
| 0.01525 | 1 |
| 0.01526 | 1 |
| 0.01527 | 1 |
| 0.01528 | 1 |
| 0.01529 | 1 |
| 0.0153 | 1 |
| 0.01531 | 1 |
| 0.01532 | 1 |
| 0.01533 | 1 |
| 0.01534 | 1 |
| 0.01535 | 1 |
| 0.01536 | 1 |
| 0.01537 | 1 |
| 0.01538 | 1 |
| 0.01539 | 1 |
| 0.0154 | 1 |
| 0.01541 | 1 |
| 0.01542 | 1 |
| 0.01543 | 1 |
| 0.01544 | 1 |
| 0.01545 | 1 |
| 0.01546 | 1 |
| 0.01547 | 1 |
| 0.01548 | 1 |
| 0.01549 | 1 |
| 0.0155 | 1 |
| 0.01551 | 1 |
| 0.01552 | 1 |
| 0.01553 | 1 |
| 0.01554 | 1 |
| 0.01555 | 1 |
| 0.01556 | 1 |
| 0.01557 | 1 |
| 0.01558 | 1 |
| 0.01559 | 1 |
| 0.0156 | 1 |
| 0.01561 | 1 |
| 0.01562 | 1 |
| 0.01563 | 1 |
| 0.01564 | 1 |
| 0.01565 | 1 |
| 0.01566 | 1 |
| 0.01567 | 1 |
| 0.01568 | 1 |
| 0.01569 | 1 |
| 0.0157 | 1 |
| 0.01571 | 1 |
| 0.01572 | 1 |
| 0.01573 | 1 |
| 0.01574 | 1 |
| 0.01575 | 1 |
| 0.01576 | 1 |
| 0.01577 | 1 |
| 0.01578 | 1 |
| 0.01579 | 1 |
| 0.0158 | 1 |
| 0.01581 | 1 |
| 0.01582 | 1 |
| 0.01583 | 1 |
| 0.01584 | 1 |
| 0.01585 | 1 |
| 0.01586 | 1 |
| 0.01587 | 1 |
| 0.01588 | 1 |
| 0.01589 | 1 |
| 0.0159 | 1 |
| 0.01591 | 1 |
| 0.01592 | 1 |
| 0.01593 | 1 |
| 0.01594 | 1 |
| 0.01595 | 1 |
| 0.01596 | 1 |
| 0.01597 | 1 |
| 0.01598 | 1 |
| 0.01599 | 1 |
| 0.016 | 1 |
| 0.01601 | 1 |
| 0.01602 | 1 |
| 0.01603 | 1 |
| 0.01604 | 1 |
| 0.01605 | 1 |
| 0.01606 | 1 |
| 0.01607 | 1 |
| 0.01608 | 1 |
| 0.01609 | 1 |
| 0.0161 | 1 |
| 0.01611 | 1 |
| 0.01612 | 1 |
| 0.01613 | 1 |
| 0.01614 | 1 |
| 0.01615 | 1 |
| 0.01616 | 1 |
| 0.01617 | 1 |
| 0.01618 | 1 |
| 0.01619 | 1 |
| 0.0162 | 1 |
| 0.01621 | 1 |
| 0.01622 | 1 |
| 0.01623 | 1 |
| 0.01624 | 1 |
| 0.01625 | 1 |
| 0.01626 | 1 |
| 0.01627 | 1 |
| 0.01628 | 1 |
| 0.01629 | 1 |
| 0.0163 | 1 |
| 0.01631 | 1 |
| 0.01632 | 1 |
| 0.01633 | 1 |
| 0.01634 | 1 |
| 0.01635 | 1 |
| 0.01636 | 1 |
| 0.01637 | 1 |
| 0.01638 | 1 |
| 0.01639 | 1 |
| 0.0164 | 1 |
| 0.01641 | 1 |
| 0.01642 | 1 |
| 0.01643 | 1 |
| 0.01644 | 1 |
| 0.01645 | 1 |
| 0.01646 | 1 |
| 0.01647 | 1 |
| 0.01648 | 1 |
| 0.01649 | 1 |
| 0.0165 | 1 |
| 0.01651 | 1 |
| 0.01652 | 1 |
| 0.01653 | 1 |
| 0.01654 | 1 |
| 0.01655 | 1 |
| 0.01656 | 1 |
| 0.01657 | 1 |
| 0.01658 | 1 |
| 0.01659 | 1 |
| 0.0166 | 1 |
| 0.01661 | 1 |
| 0.01662 | 1 |
| 0.01663 | 1 |
| 0.01664 | 1 |
| 0.01665 | 1 |
| 0.01666 | 1 |
| 0.01667 | 1 |
| 0.01668 | 1 |
| 0.01669 | 1 |
| 0.0167 | 1 |
| 0.01671 | 1 |
| 0.01672 | 1 |
| 0.01673 | 1 |
| 0.01674 | 1 |
| 0.01675 | 1 |
| 0.01676 | 1 |
| 0.01677 | 1 |
| 0.01678 | 1 |
| 0.01679 | 1 |
| 0.0168 | 1 |
| 0.01681 | 1 |
| 0.01682 | 1 |
| 0.01683 | 1 |
| 0.01684 | 1 |
| 0.01685 | 1 |
| 0.01686 | 1 |
| 0.01687 | 1 |
| 0.01688 | 1 |
| 0.01689 | 1 |
| 0.0169 | 1 |
| 0.01691 | 1 |
| 0.01692 | 1 |
| 0.01693 | 1 |
| 0.01694 | 1 |
| 0.01695 | 1 |
| 0.01696 | 1 |
| 0.01697 | 1 |
| 0.01698 | 1 |
| 0.01699 | 1 |
| 0.017 | 1 |
| 0.01701 | 1 |
| 0.01702 | 1 |
| 0.01703 | 1 |
| 0.01704 | 1 |
| 0.01705 | 1 |
| 0.01706 | 1 |
| 0.01707 | 1 |
| 0.01708 | 1 |
| 0.01709 | 1 |
| 0.0171 | 1 |
| 0.01711 | 1 |
| 0.01712 | 1 |
| 0.01713 | 1 |
| 0.01714 | 1 |
| 0.01715 | 1 |
| 0.01716 | 1 |
| 0.01717 | 1 |
| 0.01718 | 1 |
| 0.01719 | 1 |
| 0.0172 | 1 |
| 0.01721 | 1 |
| 0.01722 | 1 |
| 0.01723 | 1 |
| 0.01724 | 1 |
| 0.01725 | 1 |
| 0.01726 | 1 |
| 0.01727 | 1 |
| 0.01728 | 1 |
| 0.01729 | 1 |
| 0.0173 | 1 |
| 0.01731 | 1 |
| 0.01732 | 1 |
| 0.01733 | 1 |
| 0.01734 | 1 |
| 0.01735 | 1 |
| 0.01736 | 1 |
| 0.01737 | 1 |
| 0.01738 | 1 |
| 0.01739 | 1 |
| 0.0174 | 1 |
| 0.01741 | 1 |
| 0.01742 | 1 |
| 0.01743 | 1 |
| 0.01744 | 1 |
| 0.01745 | 1 |
| 0.01746 | 1 |
| 0.01747 | 1 |
| 0.01748 | 1 |
| 0.01749 | 1 |
| 0.0175 | 1 |
| 0.01751 | 1 |
| 0.01752 | 1 |
| 0.01753 | 1 |
| 0.01754 | 1 |
| 0.01755 | 1 |
| 0.01756 | 1 |
| 0.01757 | 1 |
| 0.01758 | 1 |
| 0.01759 | 1 |
| 0.0176 | 1 |
| 0.01761 | 1 |
| 0.01762 | 1 |
| 0.01763 | 1 |
| 0.01764 | 1 |
| 0.01765 | 1 |
| 0.01766 | 1 |
| 0.01767 | 1 |
| 0.01768 | 1 |
| 0.01769 | 1 |
| 0.0177 | 1 |
| 0.01771 | 1 |
| 0.01772 | 1 |
| 0.01773 | 1 |
| 0.01774 | 1 |
| 0.01775 | 1 |
| 0.01776 | 1 |
| 0.01777 | 1 |
| 0.01778 | 1 |
| 0.01779 | 1 |
| 0.0178 | 1 |
| 0.01781 | 1 |
| 0.01782 | 1 |
| 0.01783 | 1 |
| 0.01784 | 1 |
| 0.01785 | 1 |
| 0.01786 | 1 |
| 0.01787 | 1 |
| 0.01788 | 1 |
| 0.01789 | 1 |
| 0.0179 | 1 |
| 0.01791 | 1 |
| 0.01792 | 1 |
| 0.01793 | 1 |
| 0.01794 | 1 |
| 0.01795 | 1 |
| 0.01796 | 1 |
| 0.01797 | 1 |
| 0.01798 | 1 |
| 0.01799 | 1 |
| 0.018 | 1 |
| 0.01801 | 1 |
| 0.01802 | 1 |
| 0.01803 | 1 |
| 0.01804 | 1 |
| 0.01805 | 1 |
| 0.01806 | 1 |
| 0.01807 | 1 |
| 0.01808 | 1 |
| 0.01809 | 1 |
| 0.0181 | 1 |
| 0.01811 | 1 |
| 0.01812 | 1 |
| 0.01813 | 1 |
| 0.01814 | 1 |
| 0.01815 | 1 |
| 0.01816 | 1 |
| 0.01817 | 1 |
| 0.01818 | 1 |
| 0.01819 | 1 |
| 0.0182 | 1 |
| 0.01821 | 1 |
| 0.01822 | 1 |
| 0.01823 | 1 |
| 0.01824 | 1 |
| 0.01825 | 1 |
| 0.01826 | 1 |
| 0.01827 | 1 |
| 0.01828 | 1 |
| 0.01829 | 1 |
| 0.0183 | 1 |
| 0.01831 | 1 |
| 0.01832 | 1 |
| 0.01833 | 1 |
| 0.01834 | 1 |
| 0.01835 | 1 |
| 0.01836 | 1 |
| 0.01837 | 1 |
| 0.01838 | 1 |
| 0.01839 | 1 |
| 0.0184 | 1 |
| 0.01841 | 1 |
| 0.01842 | 1 |
| 0.01843 | 1 |
| 0.01844 | 1 |
| 0.01845 | 1 |
| 0.01846 | 1 |
| 0.01847 | 1 |
| 0.01848 | 1 |
| 0.01849 | 1 |
| 0.0185 | 1 |
| 0.01851 | 1 |
| 0.01852 | 1 |
| 0.01853 | 1 |
| 0.01854 | 1 |
| 0.01855 | 1 |
| 0.01856 | 1 |
| 0.01857 | 1 |
| 0.01858 | 1 |
| 0.01859 | 1 |
| 0.0186 | 1 |
| 0.01861 | 1 |
| 0.01862 | 1 |
| 0.01863 | 1 |
| 0.01864 | 1 |
| 0.01865 | 1 |
| 0.01866 | 1 |
| 0.01867 | 1 |
| 0.01868 | 1 |
| 0.01869 | 1 |
| 0.0187 | 1 |
| 0.01871 | 1 |
| 0.01872 | 1 |
| 0.01873 | 1 |
| 0.01874 | 1 |
| 0.01875 | 1 |
| 0.01876 | 1 |
| 0.01877 | 1 |
| 0.01878 | 1 |
| 0.01879 | 1 |
| 0.0188 | 1 |
| 0.01881 | 1 |
| 0.01882 | 1 |
| 0.01883 | 1 |
| 0.01884 | 1 |
| 0.01885 | 1 |
| 0.01886 | 1 |
| 0.01887 | 1 |
| 0.01888 | 1 |
| 0.01889 | 1 |
| 0.0189 | 1 |
| 0.01891 | 1 |
| 0.01892 | 1 |
| 0.01893 | 1 |
| 0.01894 | 1 |
| 0.01895 | 1 |
| 0.01896 | 1 |
| 0.01897 | 1 |
| 0.01898 | 1 |
| 0.01899 | 1 |
| 0.019 | 1 |
| 0.01901 | 1 |
| 0.01902 | 1 |
| 0.01903 | 1 |
| 0.01904 | 1 |
| 0.01905 | 1 |
| 0.01906 | 1 |
| 0.01907 | 1 |
| 0.01908 | 1 |
| 0.01909 | 1 |
| 0.0191 | 1 |
| 0.01911 | 1 |
| 0.01912 | 1 |
| 0.01913 | 1 |
| 0.01914 | 1 |
| 0.01915 | 1 |
| 0.01916 | 1 |
| 0.01917 | 1 |
| 0.01918 | 1 |
| 0.01919 | 1 |
| 0.0192 | 1 |
| 0.01921 | 1 |
| 0.01922 | 1 |
| 0.01923 | 1 |
| 0.01924 | 1 |
| 0.01925 | 1 |
| 0.01926 | 1 |
| 0.01927 | 1 |
| 0.01928 | 1 |
| 0.01929 | 1 |
| 0.0193 | 1 |
| 0.01931 | 1 |
| 0.01932 | 1 |
| 0.01933 | 1 |
| 0.01934 | 1 |
| 0.01935 | 1 |
| 0.01936 | 1 |
| 0.01937 | 1 |
| 0.01938 | 1 |
| 0.01939 | 1 |
| 0.0194 | 1 |
| 0.01941 | 1 |
| 0.01942 | 1 |
| 0.01943 | 1 |
| 0.01944 | 1 |
| 0.01945 | 1 |
| 0.01946 | 1 |
| 0.01947 | 1 |
| 0.01948 | 1 |
| 0.01949 | 1 |
| 0.0195 | 1 |
| 0.01951 | 1 |
| 0.01952 | 1 |
| 0.01953 | 1 |
| 0.01954 | 1 |
| 0.01955 | 1 |
| 0.01956 | 1 |
| 0.01957 | 1 |
| 0.01958 | 1 |
| 0.01959 | 1 |
| 0.0196 | 1 |
| 0.01961 | 1 |
| 0.01962 | 1 |
| 0.01963 | 1 |
| 0.01964 | 1 |
| 0.01965 | 1 |
| 0.01966 | 1 |
| 0.01967 | 1 |
| 0.01968 | 1 |
| 0.01969 | 1 |
| 0.0197 | 1 |
| 0.01971 | 1 |
| 0.01972 | 1 |
| 0.01973 | 1 |
| 0.01974 | 1 |
| 0.01975 | 1 |
| 0.01976 | 1 |
| 0.01977 | 1 |
| 0.01978 | 1 |
| 0.01979 | 1 |
| 0.0198 | 1 |
| 0.01981 | 1 |
| 0.01982 | 1 |
| 0.01983 | 1 |
| 0.01984 | 1 |
| 0.01985 | 1 |
| 0.01986 | 1 |
| 0.01987 | 1 |
| 0.01988 | 1 |
| 0.01989 | 1 |
| 0.0199 | 1 |
| 0.01991 | 1 |
| 0.01992 | 1 |
| 0.01993 | 1 |
| 0.01994 | 1 |
| 0.01995 | 1 |
| 0.01996 | 1 |
| 0.01997 | 1 |
| 0.01998 | 1 |
| 0.01999 | 1 |
| 0.02 | 1 |
| 0.02001 | 1 |
| 0.02002 | 1 |
| 0.02003 | 1 |
| 0.02004 | 1 |
| 0.02005 | 1 |
| 0.02006 | 1 |
| 0.02007 | 1 |
| 0.02008 | 1 |
| 0.02009 | 1 |
| 0.0201 | 1 |
| 0.02011 | 1 |
| 0.02012 | 1 |
| 0.02013 | 1 |
| 0.02014 | 1 |
| 0.02015 | 1 |
| 0.02016 | 1 |
| 0.02017 | 1 |
| 0.02018 | 1 |
| 0.02019 | 1 |
| 0.0202 | 1 |
| 0.02021 | 1 |
| 0.02022 | 1 |
| 0.02023 | 1 |
| 0.02024 | 1 |
| 0.02025 | 1 |
| 0.02026 | 1 |
| 0.02027 | 1 |
| 0.02028 | 1 |
| 0.02029 | 1 |
| 0.0203 | 1 |
| 0.02031 | 1 |
| 0.02032 | 1 |
| 0.02033 | 1 |
| 0.02034 | 1 |
| 0.02035 | 1 |
| 0.02036 | 1 |
| 0.02037 | 1 |
| 0.02038 | 1 |
| 0.02039 | 1 |
| 0.0204 | 1 |
| 0.02041 | 1 |
| 0.02042 | 1 |
| 0.02043 | 1 |
| 0.02044 | 1 |
| 0.02045 | 1 |
| 0.02046 | 1 |
| 0.02047 | 1 |
| 0.02048 | 1 |
| 0.02049 | 1 |
| 0.0205 | 1 |
| 0.02051 | 1 |
| 0.02052 | 1 |
| 0.02053 | 1 |
| 0.02054 | 1 |
| 0.02055 | 1 |
| 0.02056 | 1 |
| 0.02057 | 1 |
| 0.02058 | 1 |
| 0.02059 | 1 |
| 0.0206 | 1 |
| 0.02061 | 1 |
| 0.02062 | 1 |
| 0.02063 | 1 |
| 0.02064 | 1 |
| 0.02065 | 1 |
| 0.02066 | 1 |
| 0.02067 | 1 |
| 0.02068 | 1 |
| 0.02069 | 1 |
| 0.0207 | 1 |
| 0.02071 | 1 |
| 0.02072 | 1 |
| 0.02073 | 1 |
| 0.02074 | 1 |
| 0.02075 | 1 |
| 0.02076 | 1 |
| 0.02077 | 1 |
| 0.02078 | 1 |
| 0.02079 | 1 |
| 0.0208 | 1 |
| 0.02081 | 1 |
| 0.02082 | 1 |
| 0.02083 | 1 |
| 0.02084 | 1 |
| 0.02085 | 1 |
| 0.02086 | 1 |
| 0.02087 | 1 |
| 0.02088 | 1 |
| 0.02089 | 1 |
| 0.0209 | 1 |
| 0.02091 | 1 |
| 0.02092 | 1 |
| 0.02093 | 1 |
| 0.02094 | 1 |
| 0.02095 | 1 |
| 0.02096 | 1 |
| 0.02097 | 1 |
| 0.02098 | 1 |
| 0.02099 | 1 |
| 0.021 | 1 |
| 0.02101 | 1 |
| 0.02102 | 1 |
| 0.02103 | 1 |
| 0.02104 | 1 |
| 0.02105 | 1 |
| 0.02106 | 1 |
| 0.02107 | 1 |
| 0.02108 | 1 |
| 0.02109 | 1 |
| 0.0211 | 1 |
| 0.02111 | 1 |
| 0.02112 | 1 |
| 0.02113 | 1 |
| 0.02114 | 1 |
| 0.02115 | 1 |
| 0.02116 | 1 |
| 0.02117 | 1 |
| 0.02118 | 1 |
| 0.02119 | 1 |
| 0.0212 | 1 |
| 0.02121 | 1 |
| 0.02122 | 1 |
| 0.02123 | 1 |
| 0.02124 | 1 |
| 0.02125 | 1 |
| 0.02126 | 1 |
| 0.02127 | 1 |
| 0.02128 | 1 |
| 0.02129 | 1 |
| 0.0213 | 1 |
| 0.02131 | 1 |
| 0.02132 | 1 |
| 0.02133 | 1 |
| 0.02134 | 1 |
| 0.02135 | 1 |
| 0.02136 | 1 |
| 0.02137 | 1 |
| 0.02138 | 1 |
| 0.02139 | 1 |
| 0.0214 | 1 |
| 0.02141 | 1 |
| 0.02142 | 1 |
| 0.02143 | 0.999 |
| 0.02144 | 0.999 |
| 0.02145 | 0.999 |
| 0.02146 | 0.999 |
| 0.02147 | 0.999 |
| 0.02148 | 0.999 |
| 0.02149 | 0.999 |
| 0.0215 | 0.999 |
| 0.02151 | 0.999 |
| 0.02152 | 0.999 |
| 0.02153 | 0.999 |
| 0.02154 | 0.999 |
| 0.02155 | 0.999 |
| 0.02156 | 0.999 |
| 0.02157 | 0.999 |
| 0.02158 | 0.999 |
| 0.02159 | 0.999 |
| 0.0216 | 0.999 |
| 0.02161 | 0.999 |
| 0.02162 | 0.999 |
| 0.02163 | 0.999 |
| 0.02164 | 0.999 |
| 0.02165 | 0.999 |
| 0.02166 | 0.999 |
| 0.02167 | 0.999 |
| 0.02168 | 0.999 |
| 0.02169 | 0.999 |
| 0.0217 | 0.999 |
| 0.02171 | 0.999 |
| 0.02172 | 0.999 |
| 0.02173 | 0.999 |
| 0.02174 | 0.999 |
| 0.02175 | 0.999 |
| 0.02176 | 0.999 |
| 0.02177 | 0.999 |
| 0.02178 | 0.999 |
| 0.02179 | 0.999 |
| 0.0218 | 0.999 |
| 0.02181 | 0.999 |
| 0.02182 | 0.999 |
| 0.02183 | 0.999 |
| 0.02184 | 0.999 |
| 0.02185 | 0.999 |
| 0.02186 | 0.999 |
| 0.02187 | 0.999 |
| 0.02188 | 0.999 |
| 0.02189 | 0.999 |
| 0.0219 | 0.999 |
| 0.02191 | 0.999 |
| 0.02192 | 0.999 |
| 0.02193 | 0.999 |
| 0.02194 | 0.999 |
| 0.02195 | 0.999 |
| 0.02196 | 0.999 |
| 0.02197 | 0.999 |
| 0.02198 | 0.999 |
| 0.02199 | 0.999 |
| 0.022 | 0.999 |
| 0.02201 | 0.999 |
| 0.02202 | 0.999 |
| 0.02203 | 0.999 |
| 0.02204 | 0.999 |
| 0.02205 | 0.999 |
| 0.02206 | 0.999 |
| 0.02207 | 0.999 |
| 0.02208 | 0.999 |
| 0.02209 | 0.999 |
| 0.0221 | 0.999 |
| 0.02211 | 0.999 |
| 0.02212 | 0.999 |
| 0.02213 | 0.999 |
| 0.02214 | 0.999 |
| 0.02215 | 0.999 |
| 0.02216 | 0.999 |
| 0.02217 | 0.999 |
| 0.02218 | 0.999 |
| 0.02219 | 0.999 |
| 0.0222 | 0.999 |
| 0.02221 | 0.999 |
| 0.02222 | 0.999 |
| 0.02223 | 0.999 |
| 0.02224 | 0.999 |
| 0.02225 | 0.999 |
| 0.02226 | 0.999 |
| 0.02227 | 0.999 |
| 0.02228 | 0.999 |
| 0.02229 | 0.999 |
| 0.0223 | 0.999 |
| 0.02231 | 0.999 |
| 0.02232 | 0.999 |
| 0.02233 | 0.999 |
| 0.02234 | 0.999 |
| 0.02235 | 0.999 |
| 0.02236 | 0.999 |
| 0.02237 | 0.999 |
| 0.02238 | 0.999 |
| 0.02239 | 0.999 |
| 0.0224 | 0.999 |
| 0.02241 | 0.999 |
| 0.02242 | 0.999 |
| 0.02243 | 0.999 |
| 0.02244 | 0.999 |
| 0.02245 | 0.999 |
| 0.02246 | 0.999 |
| 0.02247 | 0.999 |
| 0.02248 | 0.999 |
| 0.02249 | 0.999 |
| 0.0225 | 0.999 |
| 0.02251 | 0.999 |
| 0.02252 | 0.999 |
| 0.02253 | 0.999 |
| 0.02254 | 0.999 |
| 0.02255 | 0.999 |
| 0.02256 | 0.999 |
| 0.02257 | 0.999 |
| 0.02258 | 0.999 |
| 0.02259 | 0.999 |
| 0.0226 | 0.999 |
| 0.02261 | 0.999 |
| 0.02262 | 0.999 |
| 0.02263 | 0.999 |
| 0.02264 | 0.999 |
| 0.02265 | 0.999 |
| 0.02266 | 0.999 |
| 0.02267 | 0.999 |
| 0.02268 | 0.999 |
| 0.02269 | 0.999 |
| 0.0227 | 0.999 |
| 0.02271 | 0.999 |
| 0.02272 | 0.999 |
| 0.02273 | 0.999 |
| 0.02274 | 0.999 |
| 0.02275 | 0.999 |
| 0.02276 | 0.999 |
| 0.02277 | 0.999 |
| 0.02278 | 0.999 |
| 0.02279 | 0.999 |
| 0.0228 | 0.999 |
| 0.02281 | 0.999 |
| 0.02282 | 0.999 |
| 0.02283 | 0.999 |
| 0.02284 | 0.999 |
| 0.02285 | 0.999 |
| 0.02286 | 0.999 |
| 0.02287 | 0.999 |
| 0.02288 | 0.999 |
| 0.02289 | 0.999 |
| 0.0229 | 0.999 |
| 0.02291 | 0.999 |
| 0.02292 | 0.999 |
| 0.02293 | 0.999 |
| 0.02294 | 0.999 |
| 0.02295 | 0.999 |
| 0.02296 | 0.999 |
| 0.02297 | 0.999 |
| 0.02298 | 0.999 |
| 0.02299 | 0.999 |
| 0.023 | 0.999 |
| 0.02301 | 0.999 |
| 0.02302 | 0.999 |
| 0.02303 | 0.999 |
| 0.02304 | 0.999 |
| 0.02305 | 0.999 |
| 0.02306 | 0.999 |
| 0.02307 | 0.999 |
| 0.02308 | 0.999 |
| 0.02309 | 0.999 |
| 0.0231 | 0.999 |
| 0.02311 | 0.999 |
| 0.02312 | 0.999 |
| 0.02313 | 0.999 |
| 0.02314 | 0.999 |
| 0.02315 | 0.999 |
| 0.02316 | 0.999 |
| 0.02317 | 0.999 |
| 0.02318 | 0.999 |
| 0.02319 | 0.999 |
| 0.0232 | 0.999 |
| 0.02321 | 0.999 |
| 0.02322 | 0.999 |
| 0.02323 | 0.999 |
| 0.02324 | 0.999 |
| 0.02325 | 0.999 |
| 0.02326 | 0.999 |
| 0.02327 | 0.999 |
| 0.02328 | 0.999 |
| 0.02329 | 0.999 |
| 0.0233 | 0.999 |
| 0.02331 | 0.999 |
| 0.02332 | 0.999 |
| 0.02333 | 0.999 |
| 0.02334 | 0.999 |
| 0.02335 | 0.999 |
| 0.02336 | 0.999 |
| 0.02337 | 0.999 |
| 0.02338 | 0.999 |
| 0.02339 | 0.999 |
| 0.0234 | 0.999 |
| 0.02341 | 0.999 |
| 0.02342 | 0.999 |
| 0.02343 | 0.999 |
| 0.02344 | 0.999 |
| 0.02345 | 0.999 |
| 0.02346 | 0.999 |
| 0.02347 | 0.999 |
| 0.02348 | 0.999 |
| 0.02349 | 0.999 |
| 0.0235 | 0.999 |
| 0.02351 | 0.999 |
| 0.02352 | 0.999 |
| 0.02353 | 0.999 |
| 0.02354 | 0.999 |
| 0.02355 | 0.999 |
| 0.02356 | 0.999 |
| 0.02357 | 0.999 |
| 0.02358 | 0.999 |
| 0.02359 | 0.999 |
| 0.0236 | 0.999 |
| 0.02361 | 0.999 |
| 0.02362 | 0.999 |
| 0.02363 | 0.999 |
| 0.02364 | 0.999 |
| 0.02365 | 0.999 |
| 0.02366 | 0.999 |
| 0.02367 | 0.999 |
| 0.02368 | 0.999 |
| 0.02369 | 0.999 |
| 0.0237 | 0.999 |
| 0.02371 | 0.999 |
| 0.02372 | 0.999 |
| 0.02373 | 0.999 |
| 0.02374 | 0.999 |
| 0.02375 | 0.999 |
| 0.02376 | 0.999 |
| 0.02377 | 0.999 |
| 0.02378 | 0.999 |
| 0.02379 | 0.999 |
| 0.0238 | 0.999 |
| 0.02381 | 0.999 |
| 0.02382 | 0.999 |
| 0.02383 | 0.999 |
| 0.02384 | 0.999 |
| 0.02385 | 0.999 |
| 0.02386 | 0.999 |
| 0.02387 | 0.999 |
| 0.02388 | 0.999 |
| 0.02389 | 0.999 |
| 0.0239 | 0.999 |
| 0.02391 | 0.999 |
| 0.02392 | 0.999 |
| 0.02393 | 0.999 |
| 0.02394 | 0.999 |
| 0.02395 | 0.999 |
| 0.02396 | 0.999 |
| 0.02397 | 0.999 |
| 0.02398 | 0.999 |
| 0.02399 | 0.999 |
| 0.024 | 0.999 |
| 0.02401 | 0.999 |
| 0.02402 | 0.999 |
| 0.02403 | 0.999 |
| 0.02404 | 0.999 |
| 0.02405 | 0.999 |
| 0.02406 | 0.999 |
| 0.02407 | 0.999 |
| 0.02408 | 0.999 |
| 0.02409 | 0.999 |
| 0.0241 | 0.999 |
| 0.02411 | 0.999 |
| 0.02412 | 0.999 |
| 0.02413 | 0.999 |
| 0.02414 | 0.999 |
| 0.02415 | 0.999 |
| 0.02416 | 0.999 |
| 0.02417 | 0.999 |
| 0.02418 | 0.999 |
| 0.02419 | 0.999 |
| 0.0242 | 0.999 |
| 0.02421 | 0.999 |
| 0.02422 | 0.999 |
| 0.02423 | 0.999 |
| 0.02424 | 0.999 |
| 0.02425 | 0.999 |
| 0.02426 | 0.999 |
| 0.02427 | 0.999 |
| 0.02428 | 0.999 |
| 0.02429 | 0.999 |
| 0.0243 | 0.999 |
| 0.02431 | 0.999 |
| 0.02432 | 0.999 |
| 0.02433 | 0.999 |
| 0.02434 | 0.999 |
| 0.02435 | 0.999 |
| 0.02436 | 0.999 |
| 0.02437 | 0.999 |
| 0.02438 | 0.999 |
| 0.02439 | 0.999 |
| 0.0244 | 0.999 |
| 0.02441 | 0.999 |
| 0.02442 | 0.999 |
| 0.02443 | 0.999 |
| 0.02444 | 0.999 |
| 0.02445 | 0.999 |
| 0.02446 | 0.999 |
| 0.02447 | 0.999 |
| 0.02448 | 0.999 |
| 0.02449 | 0.999 |
| 0.0245 | 0.999 |
| 0.02451 | 0.999 |
| 0.02452 | 0.999 |
| 0.02453 | 0.999 |
| 0.02454 | 0.999 |
| 0.02455 | 0.999 |
| 0.02456 | 0.999 |
| 0.02457 | 0.999 |
| 0.02458 | 0.999 |
| 0.02459 | 0.999 |
| 0.0246 | 0.999 |
| 0.02461 | 0.999 |
| 0.02462 | 0.999 |
| 0.02463 | 0.999 |
| 0.02464 | 0.999 |
| 0.02465 | 0.999 |
| 0.02466 | 0.999 |
| 0.02467 | 0.999 |
| 0.02468 | 0.999 |
| 0.02469 | 0.999 |
| 0.0247 | 0.999 |
| 0.02471 | 0.999 |
| 0.02472 | 0.999 |
| 0.02473 | 0.999 |
| 0.02474 | 0.999 |
| 0.02475 | 0.999 |
| 0.02476 | 0.999 |
| 0.02477 | 0.999 |
| 0.02478 | 0.999 |
| 0.02479 | 0.999 |
| 0.0248 | 0.999 |
| 0.02481 | 0.999 |
| 0.02482 | 0.999 |
| 0.02483 | 0.999 |
| 0.02484 | 0.999 |
| 0.02485 | 0.999 |
| 0.02486 | 0.999 |
| 0.02487 | 0.999 |
| 0.02488 | 0.999 |
| 0.02489 | 0.999 |
| 0.0249 | 0.999 |
| 0.02491 | 0.999 |
| 0.02492 | 0.999 |
| 0.02493 | 0.999 |
| 0.02494 | 0.999 |
| 0.02495 | 0.999 |
| 0.02496 | 0.999 |
| 0.02497 | 0.999 |
| 0.02498 | 0.999 |
| 0.02499 | 0.999 |
| 0.025 | 0.999 |
| 0.02501 | 0.999 |
| 0.02502 | 0.999 |
| 0.02503 | 0.999 |
| 0.02504 | 0.999 |
| 0.02505 | 0.999 |
| 0.02506 | 0.999 |
| 0.02507 | 0.999 |
| 0.02508 | 0.999 |
| 0.02509 | 0.999 |
| 0.0251 | 0.999 |
| 0.02511 | 0.999 |
| 0.02512 | 0.999 |
| 0.02513 | 0.999 |
| 0.02514 | 0.999 |
| 0.02515 | 0.999 |
| 0.02516 | 0.999 |
| 0.02517 | 0.999 |
| 0.02518 | 0.999 |
| 0.02519 | 0.999 |
| 0.0252 | 0.999 |
| 0.02521 | 0.999 |
| 0.02522 | 0.999 |
| 0.02523 | 0.999 |
| 0.02524 | 0.999 |
| 0.02525 | 0.999 |
| 0.02526 | 0.999 |
| 0.02527 | 0.999 |
| 0.02528 | 0.999 |
| 0.02529 | 0.999 |
| 0.0253 | 0.999 |
| 0.02531 | 0.999 |
| 0.02532 | 0.999 |
| 0.02533 | 0.999 |
| 0.02534 | 0.999 |
| 0.02535 | 0.999 |
| 0.02536 | 0.999 |
| 0.02537 | 0.999 |
| 0.02538 | 0.999 |
| 0.02539 | 0.999 |
| 0.0254 | 0.999 |
| 0.02541 | 0.999 |
| 0.02542 | 0.999 |
| 0.02543 | 0.999 |
| 0.02544 | 0.999 |
| 0.02545 | 0.999 |
| 0.02546 | 0.999 |
| 0.02547 | 0.999 |
| 0.02548 | 0.999 |
| 0.02549 | 0.999 |
| 0.0255 | 0.999 |
| 0.02551 | 0.999 |
| 0.02552 | 0.999 |
| 0.02553 | 0.999 |
| 0.02554 | 0.999 |
| 0.02555 | 0.999 |
| 0.02556 | 0.999 |
| 0.02557 | 0.999 |
| 0.02558 | 0.999 |
| 0.02559 | 0.999 |
| 0.0256 | 0.999 |
| 0.02561 | 0.999 |
| 0.02562 | 0.999 |
| 0.02563 | 0.999 |
| 0.02564 | 0.999 |
| 0.02565 | 0.999 |
| 0.02566 | 0.999 |
| 0.02567 | 0.999 |
| 0.02568 | 0.999 |
| 0.02569 | 0.999 |
| 0.0257 | 0.999 |
| 0.02571 | 0.999 |
| 0.02572 | 0.999 |
| 0.02573 | 0.999 |
| 0.02574 | 0.999 |
| 0.02575 | 0.999 |
| 0.02576 | 0.999 |
| 0.02577 | 0.999 |
| 0.02578 | 0.999 |
| 0.02579 | 0.999 |
| 0.0258 | 0.999 |
| 0.02581 | 0.999 |
| 0.02582 | 0.999 |
| 0.02583 | 0.999 |
| 0.02584 | 0.999 |
| 0.02585 | 0.999 |
| 0.02586 | 0.999 |
| 0.02587 | 0.999 |
| 0.02588 | 0.999 |
| 0.02589 | 0.999 |
| 0.0259 | 0.999 |
| 0.02591 | 0.999 |
| 0.02592 | 0.999 |
| 0.02593 | 0.999 |
| 0.02594 | 0.999 |
| 0.02595 | 0.999 |
| 0.02596 | 0.999 |
| 0.02597 | 0.999 |
| 0.02598 | 0.999 |
| 0.02599 | 0.999 |
| 0.026 | 0.999 |
| 0.02601 | 0.999 |
| 0.02602 | 0.999 |
| 0.02603 | 0.999 |
| 0.02604 | 0.999 |
| 0.02605 | 0.999 |
| 0.02606 | 0.999 |
| 0.02607 | 0.999 |
| 0.02608 | 0.999 |
| 0.02609 | 0.999 |
| 0.0261 | 0.999 |
| 0.02611 | 0.999 |
| 0.02612 | 0.999 |
| 0.02613 | 0.999 |
| 0.02614 | 0.999 |
| 0.02615 | 0.999 |
| 0.02616 | 0.999 |
| 0.02617 | 0.999 |
| 0.02618 | 0.999 |
| 0.02619 | 0.999 |
| 0.0262 | 0.999 |
| 0.02621 | 0.999 |
| 0.02622 | 0.999 |
| 0.02623 | 0.999 |
| 0.02624 | 0.999 |
| 0.02625 | 0.999 |
| 0.02626 | 0.999 |
| 0.02627 | 0.999 |
| 0.02628 | 0.999 |
| 0.02629 | 0.999 |
| 0.0263 | 0.999 |
| 0.02631 | 0.999 |
| 0.02632 | 0.999 |
| 0.02633 | 0.999 |
| 0.02634 | 0.999 |
| 0.02635 | 0.999 |
| 0.02636 | 0.999 |
| 0.02637 | 0.999 |
| 0.02638 | 0.999 |
| 0.02639 | 0.999 |
| 0.0264 | 0.999 |
| 0.02641 | 0.999 |
| 0.02642 | 0.999 |
| 0.02643 | 0.999 |
| 0.02644 | 0.999 |
| 0.02645 | 0.999 |
| 0.02646 | 0.999 |
| 0.02647 | 0.999 |
| 0.02648 | 0.999 |
| 0.02649 | 0.999 |
| 0.0265 | 0.999 |
| 0.02651 | 0.999 |
| 0.02652 | 0.999 |
| 0.02653 | 0.999 |
| 0.02654 | 0.999 |
| 0.02655 | 0.999 |
| 0.02656 | 0.999 |
| 0.02657 | 0.999 |
| 0.02658 | 0.999 |
| 0.02659 | 0.999 |
| 0.0266 | 0.999 |
| 0.02661 | 0.999 |
| 0.02662 | 0.999 |
| 0.02663 | 0.999 |
| 0.02664 | 0.999 |
| 0.02665 | 0.999 |
| 0.02666 | 0.999 |
| 0.02667 | 0.999 |
| 0.02668 | 0.999 |
| 0.02669 | 0.999 |
| 0.0267 | 0.999 |
| 0.02671 | 0.999 |
| 0.02672 | 0.999 |
| 0.02673 | 0.999 |
| 0.02674 | 0.999 |
| 0.02675 | 0.999 |
| 0.02676 | 0.999 |
| 0.02677 | 0.999 |
| 0.02678 | 0.999 |
| 0.02679 | 0.999 |
| 0.0268 | 0.999 |
| 0.02681 | 0.999 |
| 0.02682 | 0.999 |
| 0.02683 | 0.999 |
| 0.02684 | 0.999 |
| 0.02685 | 0.999 |
| 0.02686 | 0.999 |
| 0.02687 | 0.999 |
| 0.02688 | 0.999 |
| 0.02689 | 0.999 |
| 0.0269 | 0.999 |
| 0.02691 | 0.999 |
| 0.02692 | 0.999 |
| 0.02693 | 0.999 |
| 0.02694 | 0.999 |
| 0.02695 | 0.999 |
| 0.02696 | 0.999 |
| 0.02697 | 0.999 |
| 0.02698 | 0.999 |
| 0.02699 | 0.999 |
| 0.027 | 0.999 |
| 0.02701 | 0.999 |
| 0.02702 | 0.999 |
| 0.02703 | 0.999 |
| 0.02704 | 0.999 |
| 0.02705 | 0.999 |
| 0.02706 | 0.999 |
| 0.02707 | 0.999 |
| 0.02708 | 0.999 |
| 0.02709 | 0.999 |
| 0.0271 | 0.999 |
| 0.02711 | 0.999 |
| 0.02712 | 0.999 |
| 0.02713 | 0.999 |
| 0.02714 | 0.999 |
| 0.02715 | 0.999 |
| 0.02716 | 0.999 |
| 0.02717 | 0.999 |
| 0.02718 | 0.999 |
| 0.02719 | 0.999 |
| 0.0272 | 0.999 |
| 0.02721 | 0.999 |
| 0.02722 | 0.999 |
| 0.02723 | 0.999 |
| 0.02724 | 0.999 |
| 0.02725 | 0.999 |
| 0.02726 | 0.999 |
| 0.02727 | 0.999 |
| 0.02728 | 0.999 |
| 0.02729 | 0.999 |
| 0.0273 | 0.999 |
| 0.02731 | 0.999 |
| 0.02732 | 0.999 |
| 0.02733 | 0.999 |
| 0.02734 | 0.999 |
| 0.02735 | 0.999 |
| 0.02736 | 0.999 |
| 0.02737 | 0.999 |
| 0.02738 | 0.999 |
| 0.02739 | 0.999 |
| 0.0274 | 0.999 |
| 0.02741 | 0.999 |
| 0.02742 | 0.999 |
| 0.02743 | 0.999 |
| 0.02744 | 0.999 |
| 0.02745 | 0.999 |
| 0.02746 | 0.999 |
| 0.02747 | 0.999 |
| 0.02748 | 0.999 |
| 0.02749 | 0.999 |
| 0.0275 | 0.999 |
| 0.02751 | 0.999 |
| 0.02752 | 0.999 |
| 0.02753 | 0.999 |
| 0.02754 | 0.999 |
| 0.02755 | 0.999 |
| 0.02756 | 0.999 |
| 0.02757 | 0.999 |
| 0.02758 | 0.999 |
| 0.02759 | 0.999 |
| 0.0276 | 0.999 |
| 0.02761 | 0.999 |
| 0.02762 | 0.999 |
| 0.02763 | 0.999 |
| 0.02764 | 0.999 |
| 0.02765 | 0.999 |
| 0.02766 | 0.999 |
| 0.02767 | 0.999 |
| 0.02768 | 0.999 |
| 0.02769 | 0.999 |
| 0.0277 | 0.999 |
| 0.02771 | 0.999 |
| 0.02772 | 0.999 |
| 0.02773 | 0.999 |
| 0.02774 | 0.999 |
| 0.02775 | 0.999 |
| 0.02776 | 0.999 |
| 0.02777 | 0.999 |
| 0.02778 | 0.999 |
| 0.02779 | 0.999 |
| 0.0278 | 0.999 |
| 0.02781 | 0.999 |
| 0.02782 | 0.999 |
| 0.02783 | 0.999 |
| 0.02784 | 0.999 |
| 0.02785 | 0.999 |
| 0.02786 | 0.999 |
| 0.02787 | 0.999 |
| 0.02788 | 0.999 |
| 0.02789 | 0.999 |
| 0.0279 | 0.999 |
| 0.02791 | 0.999 |
| 0.02792 | 0.999 |
| 0.02793 | 0.999 |
| 0.02794 | 0.999 |
| 0.02795 | 0.999 |
| 0.02796 | 0.999 |
| 0.02797 | 0.999 |
| 0.02798 | 0.999 |
| 0.02799 | 0.999 |
| 0.028 | 0.999 |
| 0.02801 | 0.999 |
| 0.02802 | 0.999 |
| 0.02803 | 0.999 |
| 0.02804 | 0.999 |
| 0.02805 | 0.999 |
| 0.02806 | 0.999 |
| 0.02807 | 0.999 |
| 0.02808 | 0.999 |
| 0.02809 | 0.999 |
| 0.0281 | 1 |
| 0.02811 | 1 |
| 0.02812 | 1 |
| 0.02813 | 1 |
| 0.02814 | 1 |
| 0.02815 | 1 |
| 0.02816 | 1 |
| 0.02817 | 1 |
| 0.02818 | 1 |
| 0.02819 | 1 |
| 0.0282 | 1 |
| 0.02821 | 1 |
| 0.02822 | 1 |
| 0.02823 | 1 |
| 0.02824 | 1 |
| 0.02825 | 1 |
| 0.02826 | 1 |
| 0.02827 | 1 |
| 0.02828 | 1 |
| 0.02829 | 1 |
| 0.0283 | 1 |
| 0.02831 | 1 |
| 0.02832 | 1 |
| 0.02833 | 1 |
| 0.02834 | 1 |
| 0.02835 | 1 |
| 0.02836 | 1 |
| 0.02837 | 1 |
| 0.02838 | 1 |
| 0.02839 | 1 |
| 0.0284 | 1 |
| 0.02841 | 1 |
| 0.02842 | 1 |
| 0.02843 | 1 |
| 0.02844 | 1 |
| 0.02845 | 1 |
| 0.02846 | 1 |
| 0.02847 | 1 |
| 0.02848 | 1 |
| 0.02849 | 1 |
| 0.0285 | 1 |
| 0.02851 | 1 |
| 0.02852 | 1 |
| 0.02853 | 1 |
| 0.02854 | 1 |
| 0.02855 | 1 |
| 0.02856 | 1 |
| 0.02857 | 1 |
| 0.02858 | 1 |
| 0.02859 | 1 |
| 0.0286 | 1 |
| 0.02861 | 1 |
| 0.02862 | 1 |
| 0.02863 | 1 |
| 0.02864 | 1 |
| 0.02865 | 1 |
| 0.02866 | 1 |
| 0.02867 | 1 |
| 0.02868 | 1 |
| 0.02869 | 1 |
| 0.0287 | 1 |
| 0.02871 | 1 |
| 0.02872 | 1 |
| 0.02873 | 1 |
| 0.02874 | 1 |
| 0.02875 | 1 |
| 0.02876 | 1 |
| 0.02877 | 1 |
| 0.02878 | 1 |
| 0.02879 | 1 |
| 0.0288 | 1 |
| 0.02881 | 1 |
| 0.02882 | 1 |
| 0.02883 | 1 |
| 0.02884 | 1 |
| 0.02885 | 1 |
| 0.02886 | 1 |
| 0.02887 | 1 |
| 0.02888 | 1 |
| 0.02889 | 1 |
| 0.0289 | 1 |
| 0.02891 | 1 |
| 0.02892 | 1 |
| 0.02893 | 1 |
| 0.02894 | 1 |
| 0.02895 | 1 |
| 0.02896 | 1 |
| 0.02897 | 1 |
| 0.02898 | 1 |
| 0.02899 | 1 |
| 0.029 | 1 |
| 0.02901 | 1 |
| 0.02902 | 1 |
| 0.02903 | 1 |
| 0.02904 | 1 |
| 0.02905 | 1 |
| 0.02906 | 1 |
| 0.02907 | 1 |
| 0.02908 | 1 |
| 0.02909 | 1 |
| 0.0291 | 1 |
| 0.02911 | 1 |
| 0.02912 | 1 |
| 0.02913 | 1 |
| 0.02914 | 1 |
| 0.02915 | 1 |
| 0.02916 | 1 |
| 0.02917 | 1 |
| 0.02918 | 1 |
| 0.02919 | 1 |
| 0.0292 | 1 |
| 0.02921 | 1 |
| 0.02922 | 1 |
| 0.02923 | 1 |
| 0.02924 | 1 |
| 0.02925 | 1 |
| 0.02926 | 1 |
| 0.02927 | 1 |
| 0.02928 | 1 |
| 0.02929 | 1 |
| 0.0293 | 1 |
| 0.02931 | 1 |
| 0.02932 | 1 |
| 0.02933 | 1 |
| 0.02934 | 1 |
| 0.02935 | 1 |
| 0.02936 | 1 |
| 0.02937 | 1 |
| 0.02938 | 1 |
| 0.02939 | 1 |
| 0.0294 | 1 |
| 0.02941 | 1 |
| 0.02942 | 1 |
| 0.02943 | 1 |
| 0.02944 | 1 |
| 0.02945 | 1 |
| 0.02946 | 1 |
| 0.02947 | 1 |
| 0.02948 | 1 |
| 0.02949 | 1 |
| 0.0295 | 1 |
| 0.02951 | 1 |
| 0.02952 | 1 |
| 0.02953 | 1 |
| 0.02954 | 1 |
| 0.02955 | 1 |
| 0.02956 | 1 |
| 0.02957 | 1 |
| 0.02958 | 1 |
| 0.02959 | 1 |
| 0.0296 | 1 |
| 0.02961 | 1 |
| 0.02962 | 1 |
| 0.02963 | 1 |
| 0.02964 | 1 |
| 0.02965 | 1 |
| 0.02966 | 1 |
| 0.02967 | 1 |
| 0.02968 | 1 |
| 0.02969 | 1 |
| 0.0297 | 1 |
| 0.02971 | 1 |
| 0.02972 | 1 |
| 0.02973 | 1 |
| 0.02974 | 1 |
| 0.02975 | 1 |
| 0.02976 | 1 |
| 0.02977 | 1 |
| 0.02978 | 1 |
| 0.02979 | 1 |
| 0.0298 | 1 |
| 0.02981 | 1 |
| 0.02982 | 1 |
| 0.02983 | 1 |
| 0.02984 | 1 |
| 0.02985 | 1 |
| 0.02986 | 1 |
| 0.02987 | 1 |
| 0.02988 | 1 |
| 0.02989 | 1 |
| 0.0299 | 1 |
| 0.02991 | 1 |
| 0.02992 | 1 |
| 0.02993 | 1 |
| 0.02994 | 1 |
| 0.02995 | 1 |
| 0.02996 | 1 |
| 0.02997 | 1 |
| 0.02998 | 1 |
| 0.02999 | 1 |
| 0.03 | 1 |
| 0.03001 | 1 |
| 0.03002 | 1 |
| 0.03003 | 1 |
| 0.03004 | 1 |
| 0.03005 | 1 |
| 0.03006 | 1 |
| 0.03007 | 1 |
| 0.03008 | 1 |
| 0.03009 | 1 |
| 0.0301 | 1 |
| 0.03011 | 1 |
| 0.03012 | 1 |
| 0.03013 | 1 |
| 0.03014 | 1 |
| 0.03015 | 1 |
| 0.03016 | 1 |
| 0.03017 | 1 |
| 0.03018 | 1 |
| 0.03019 | 1 |
| 0.0302 | 1 |
| 0.03021 | 1 |
| 0.03022 | 1 |
| 0.03023 | 1 |
| 0.03024 | 1 |
| 0.03025 | 1 |
| 0.03026 | 1 |
| 0.03027 | 1 |
| 0.03028 | 1 |
| 0.03029 | 1 |
| 0.0303 | 1 |
| 0.03031 | 1 |
| 0.03032 | 1 |
| 0.03033 | 1 |
| 0.03034 | 1 |
| 0.03035 | 1 |
| 0.03036 | 1 |
| 0.03037 | 1 |
| 0.03038 | 1 |
| 0.03039 | 1 |
| 0.0304 | 1 |
| 0.03041 | 1 |
| 0.03042 | 1 |
| 0.03043 | 1 |
| 0.03044 | 1 |
| 0.03045 | 1 |
| 0.03046 | 1 |
| 0.03047 | 1 |
| 0.03048 | 1 |
| 0.03049 | 1 |
| 0.0305 | 1 |
| 0.03051 | 1 |
| 0.03052 | 1 |
| 0.03053 | 1 |
| 0.03054 | 1 |
| 0.03055 | 1 |
| 0.03056 | 1 |
| 0.03057 | 1 |
| 0.03058 | 1 |
| 0.03059 | 1 |
| 0.0306 | 1 |
| 0.03061 | 1 |
| 0.03062 | 1 |
| 0.03063 | 1 |
| 0.03064 | 1 |
| 0.03065 | 1 |
| 0.03066 | 1 |
| 0.03067 | 1 |
| 0.03068 | 1 |
| 0.03069 | 1 |
| 0.0307 | 1 |
| 0.03071 | 1 |
| 0.03072 | 1 |
| 0.03073 | 1 |
| 0.03074 | 1 |
| 0.03075 | 1 |
| 0.03076 | 1 |
| 0.03077 | 1 |
| 0.03078 | 1 |
| 0.03079 | 1 |
| 0.0308 | 1 |
| 0.03081 | 1 |
| 0.03082 | 1 |
| 0.03083 | 1 |
| 0.03084 | 1 |
| 0.03085 | 1 |
| 0.03086 | 1 |
| 0.03087 | 1 |
| 0.03088 | 1 |
| 0.03089 | 1 |
| 0.0309 | 1 |
| 0.03091 | 1 |
| 0.03092 | 1 |
| 0.03093 | 1 |
| 0.03094 | 1 |
| 0.03095 | 1 |
| 0.03096 | 1 |
| 0.03097 | 1 |
| 0.03098 | 1 |
| 0.03099 | 1 |
| 0.031 | 1 |
| 0.03101 | 1 |
| 0.03102 | 1 |
| 0.03103 | 1 |
| 0.03104 | 1 |
| 0.03105 | 1 |
| 0.03106 | 1 |
| 0.03107 | 1 |
| 0.03108 | 1 |
| 0.03109 | 1 |
| 0.0311 | 1 |
| 0.03111 | 1 |
| 0.03112 | 1 |
| 0.03113 | 1 |
| 0.03114 | 1 |
| 0.03115 | 1 |
| 0.03116 | 1 |
| 0.03117 | 1 |
| 0.03118 | 1 |
| 0.03119 | 1 |
| 0.0312 | 1 |
| 0.03121 | 1 |
| 0.03122 | 1 |
| 0.03123 | 1 |
| 0.03124 | 1 |
| 0.03125 | 1 |
| 0.03126 | 1 |
| 0.03127 | 1 |
| 0.03128 | 1 |
| 0.03129 | 1 |
| 0.0313 | 1 |
| 0.03131 | 1 |
| 0.03132 | 1 |
| 0.03133 | 1 |
| 0.03134 | 1 |
| 0.03135 | 1 |
| 0.03136 | 1 |
| 0.03137 | 1 |
| 0.03138 | 1 |
| 0.03139 | 1 |
| 0.0314 | 1 |
| 0.03141 | 1 |
| 0.03142 | 1 |
| 0.03143 | 1 |
| 0.03144 | 1 |
| 0.03145 | 1 |
| 0.03146 | 1 |
| 0.03147 | 1 |
| 0.03148 | 1 |
| 0.03149 | 1 |
| 0.0315 | 1 |
| 0.03151 | 1 |
| 0.03152 | 1 |
| 0.03153 | 1 |
| 0.03154 | 1 |
| 0.03155 | 1 |
| 0.03156 | 1 |
| 0.03157 | 1 |
| 0.03158 | 1 |
| 0.03159 | 1 |
| 0.0316 | 1 |
| 0.03161 | 1 |
| 0.03162 | 1 |
| 0.03163 | 1 |
| 0.03164 | 1 |
| 0.03165 | 1 |
| 0.03166 | 1 |
| 0.03167 | 1 |
| 0.03168 | 1 |
| 0.03169 | 1 |
| 0.0317 | 1 |
| 0.03171 | 1 |
| 0.03172 | 1 |
| 0.03173 | 1 |
| 0.03174 | 1 |
| 0.03175 | 1 |
| 0.03176 | 1 |
| 0.03177 | 1 |
| 0.03178 | 1 |
| 0.03179 | 1 |
| 0.0318 | 1 |
| 0.03181 | 1 |
| 0.03182 | 1 |
| 0.03183 | 1 |
| 0.03184 | 1 |
| 0.03185 | 1 |
| 0.03186 | 1 |
| 0.03187 | 1 |
| 0.03188 | 1 |
| 0.03189 | 1 |
| 0.0319 | 1 |
| 0.03191 | 1 |
| 0.03192 | 1 |
| 0.03193 | 1 |
| 0.03194 | 1 |
| 0.03195 | 1 |
| 0.03196 | 1 |
| 0.03197 | 1 |
| 0.03198 | 1 |
| 0.03199 | 1 |
| 0.032 | 1 |
| 0.03201 | 1 |
| 0.03202 | 1 |
| 0.03203 | 1 |
| 0.03204 | 1 |
| 0.03205 | 1 |
| 0.03206 | 1 |
| 0.03207 | 1 |
| 0.03208 | 1 |
| 0.03209 | 1 |
| 0.0321 | 1 |
| 0.03211 | 1 |
| 0.03212 | 1 |
| 0.03213 | 1 |
| 0.03214 | 1 |
| 0.03215 | 1 |
| 0.03216 | 1 |
| 0.03217 | 1 |
| 0.03218 | 1 |
| 0.03219 | 1 |
| 0.0322 | 1 |
| 0.03221 | 1 |
| 0.03222 | 1 |
| 0.03223 | 1 |
| 0.03224 | 1 |
| 0.03225 | 1 |
| 0.03226 | 1 |
| 0.03227 | 1 |
| 0.03228 | 1 |
| 0.03229 | 1 |
| 0.0323 | 1 |
| 0.03231 | 1 |
| 0.03232 | 1 |
| 0.03233 | 1 |
| 0.03234 | 1 |
| 0.03235 | 1 |
| 0.03236 | 1 |
| 0.03237 | 1 |
| 0.03238 | 1 |
| 0.03239 | 1 |
| 0.0324 | 1 |
| 0.03241 | 1 |
| 0.03242 | 1 |
| 0.03243 | 1 |
| 0.03244 | 1 |
| 0.03245 | 1 |
| 0.03246 | 1 |
| 0.03247 | 1 |
| 0.03248 | 1 |
| 0.03249 | 1 |
| 0.0325 | 1 |
| 0.03251 | 1 |
| 0.03252 | 1 |
| 0.03253 | 1 |
| 0.03254 | 1 |
| 0.03255 | 1 |
| 0.03256 | 1 |
| 0.03257 | 1 |
| 0.03258 | 1 |
| 0.03259 | 1 |
| 0.0326 | 1 |
| 0.03261 | 1 |
| 0.03262 | 1 |
| 0.03263 | 1 |
| 0.03264 | 1 |
| 0.03265 | 1 |
| 0.03266 | 1 |
| 0.03267 | 1 |
| 0.03268 | 1 |
| 0.03269 | 1 |
| 0.0327 | 1 |
| 0.03271 | 1 |
| 0.03272 | 1 |
| 0.03273 | 1 |
| 0.03274 | 1 |
| 0.03275 | 1 |
| 0.03276 | 1 |
| 0.03277 | 1 |
| 0.03278 | 1 |
| 0.03279 | 1 |
| 0.0328 | 1 |
| 0.03281 | 1 |
| 0.03282 | 1 |
| 0.03283 | 1 |
| 0.03284 | 1 |
| 0.03285 | 1 |
| 0.03286 | 1 |
| 0.03287 | 1 |
| 0.03288 | 1 |
| 0.03289 | 1 |
| 0.0329 | 1 |
| 0.03291 | 1 |
| 0.03292 | 1 |
| 0.03293 | 1 |
| 0.03294 | 1 |
| 0.03295 | 1 |
| 0.03296 | 1 |
| 0.03297 | 1 |
| 0.03298 | 1 |
| 0.03299 | 1 |
| 0.033 | 1 |
| 0.03301 | 1 |
| 0.03302 | 1 |
| 0.03303 | 1 |
| 0.03304 | 1 |
| 0.03305 | 1 |
| 0.03306 | 1 |
| 0.03307 | 1 |
| 0.03308 | 1 |
| 0.03309 | 1 |
| 0.0331 | 1 |
| 0.03311 | 1 |
| 0.03312 | 1 |
| 0.03313 | 1 |
| 0.03314 | 1 |
| 0.03315 | 1 |
| 0.03316 | 1 |
| 0.03317 | 1 |
| 0.03318 | 1 |
| 0.03319 | 1 |
| 0.0332 | 1 |
| 0.03321 | 1 |
| 0.03322 | 1 |
| 0.03323 | 1 |
| 0.03324 | 1 |
| 0.03325 | 1 |
| 0.03326 | 1 |
| 0.03327 | 1 |
| 0.03328 | 1 |
| 0.03329 | 1 |
| 0.0333 | 1 |
| 0.03331 | 1 |
| 0.03332 | 1 |
| 0.03333 | 1 |
| 0.03334 | 1 |
| 0.03335 | 1 |
| 0.03336 | 1 |
| 0.03337 | 1 |
| 0.03338 | 1 |
| 0.03339 | 1 |
| 0.0334 | 1 |
| 0.03341 | 1 |
| 0.03342 | 1 |
| 0.03343 | 1 |
| 0.03344 | 1 |
| 0.03345 | 1 |
| 0.03346 | 1 |
| 0.03347 | 1 |
| 0.03348 | 1 |
| 0.03349 | 1 |
| 0.0335 | 1 |
| 0.03351 | 1 |
| 0.03352 | 1 |
| 0.03353 | 1 |
| 0.03354 | 1 |
| 0.03355 | 1 |
| 0.03356 | 1 |
| 0.03357 | 1 |
| 0.03358 | 1 |
| 0.03359 | 1 |
| 0.0336 | 1 |
| 0.03361 | 1 |
| 0.03362 | 1 |
| 0.03363 | 1 |
| 0.03364 | 1 |
| 0.03365 | 1 |
| 0.03366 | 1 |
| 0.03367 | 1 |
| 0.03368 | 1 |
| 0.03369 | 1 |
| 0.0337 | 1 |
| 0.03371 | 1 |
| 0.03372 | 1 |
| 0.03373 | 1 |
| 0.03374 | 1 |
| 0.03375 | 1 |
| 0.03376 | 1 |
| 0.03377 | 1 |
| 0.03378 | 1 |
| 0.03379 | 1 |
| 0.0338 | 1 |
| 0.03381 | 1 |
| 0.03382 | 1 |
| 0.03383 | 1 |
| 0.03384 | 1 |
| 0.03385 | 1 |
| 0.03386 | 1 |
| 0.03387 | 1 |
| 0.03388 | 1 |
| 0.03389 | 1 |
| 0.0339 | 1 |
| 0.03391 | 1 |
| 0.03392 | 1 |
| 0.03393 | 1 |
| 0.03394 | 1 |
| 0.03395 | 1 |
| 0.03396 | 1 |
| 0.03397 | 1 |
| 0.03398 | 1 |
| 0.03399 | 1 |
| 0.034 | 1 |
| 0.03401 | 1 |
| 0.03402 | 1 |
| 0.03403 | 1 |
| 0.03404 | 1 |
| 0.03405 | 1 |
| 0.03406 | 1 |
| 0.03407 | 1 |
| 0.03408 | 1 |
| 0.03409 | 1 |
| 0.0341 | 1 |
| 0.03411 | 1 |
| 0.03412 | 1 |
| 0.03413 | 1 |
| 0.03414 | 1 |
| 0.03415 | 1 |
| 0.03416 | 1 |
| 0.03417 | 1 |
| 0.03418 | 1 |
| 0.03419 | 1 |
| 0.0342 | 1 |
| 0.03421 | 1 |
| 0.03422 | 1 |
| 0.03423 | 1 |
| 0.03424 | 1 |
| 0.03425 | 1 |
| 0.03426 | 1 |
| 0.03427 | 1 |
| 0.03428 | 1 |
| 0.03429 | 1 |
| 0.0343 | 1 |
| 0.03431 | 1 |
| 0.03432 | 1 |
| 0.03433 | 1 |
| 0.03434 | 1 |
| 0.03435 | 1 |
| 0.03436 | 1 |
| 0.03437 | 1 |
| 0.03438 | 1 |
| 0.03439 | 1 |
| 0.0344 | 1 |
| 0.03441 | 1 |
| 0.03442 | 1 |
| 0.03443 | 1 |
| 0.03444 | 1 |
| 0.03445 | 1 |
| 0.03446 | 1 |
| 0.03447 | 1 |
| 0.03448 | 1 |
| 0.03449 | 1 |
| 0.0345 | 1 |
| 0.03451 | 1 |
| 0.03452 | 1 |
| 0.03453 | 1 |
| 0.03454 | 1 |
| 0.03455 | 1 |
| 0.03456 | 1 |
| 0.03457 | 1 |
| 0.03458 | 1 |
| 0.03459 | 1 |
| 0.0346 | 0.999 |
| 0.03461 | 0.999 |
| 0.03462 | 0.999 |
| 0.03463 | 0.999 |
| 0.03464 | 0.999 |
| 0.03465 | 0.999 |
| 0.03466 | 0.999 |
| 0.03467 | 0.999 |
| 0.03468 | 0.999 |
| 0.03469 | 0.999 |
| 0.0347 | 0.999 |
| 0.03471 | 0.999 |
| 0.03472 | 0.999 |
| 0.03473 | 0.999 |
| 0.03474 | 0.999 |
| 0.03475 | 0.999 |
| 0.03476 | 0.999 |
| 0.03477 | 0.999 |
| 0.03478 | 0.999 |
| 0.03479 | 0.999 |
| 0.0348 | 0.999 |
| 0.03481 | 0.999 |
| 0.03482 | 0.999 |
| 0.03483 | 0.999 |
| 0.03484 | 0.999 |
| 0.03485 | 0.999 |
| 0.03486 | 0.999 |
| 0.03487 | 0.999 |
| 0.03488 | 0.999 |
| 0.03489 | 0.999 |
| 0.0349 | 0.999 |
| 0.03491 | 0.999 |
| 0.03492 | 0.999 |
| 0.03493 | 0.999 |
| 0.03494 | 0.999 |
| 0.03495 | 0.999 |
| 0.03496 | 0.999 |
| 0.03497 | 0.999 |
| 0.03498 | 0.999 |
| 0.03499 | 0.999 |
| 0.035 | 0.999 |
| 0.03501 | 0.999 |
| 0.03502 | 0.999 |
| 0.03503 | 0.999 |
| 0.03504 | 0.999 |
| 0.03505 | 0.999 |
| 0.03506 | 0.999 |
| 0.03507 | 0.999 |
| 0.03508 | 0.999 |
| 0.03509 | 0.999 |
| 0.0351 | 0.999 |
| 0.03511 | 0.999 |
| 0.03512 | 0.999 |
| 0.03513 | 0.999 |
| 0.03514 | 0.999 |
| 0.03515 | 0.999 |
| 0.03516 | 0.999 |
| 0.03517 | 0.999 |
| 0.03518 | 0.999 |
| 0.03519 | 0.999 |
| 0.0352 | 0.999 |
| 0.03521 | 0.999 |
| 0.03522 | 0.999 |
| 0.03523 | 0.999 |
| 0.03524 | 0.999 |
| 0.03525 | 0.999 |
| 0.03526 | 0.999 |
| 0.03527 | 0.999 |
| 0.03528 | 0.999 |
| 0.03529 | 0.999 |
| 0.0353 | 0.999 |
| 0.03531 | 0.999 |
| 0.03532 | 0.999 |
| 0.03533 | 0.999 |
| 0.03534 | 0.999 |
| 0.03535 | 0.999 |
| 0.03536 | 0.999 |
| 0.03537 | 0.999 |
| 0.03538 | 0.999 |
| 0.03539 | 0.999 |
| 0.0354 | 0.999 |
| 0.03541 | 0.999 |
| 0.03542 | 0.999 |
| 0.03543 | 0.999 |
| 0.03544 | 0.999 |
| 0.03545 | 0.999 |
| 0.03546 | 0.999 |
| 0.03547 | 0.999 |
| 0.03548 | 0.999 |
| 0.03549 | 0.999 |
| 0.0355 | 0.999 |
| 0.03551 | 0.999 |
| 0.03552 | 0.999 |
| 0.03553 | 0.999 |
| 0.03554 | 0.999 |
| 0.03555 | 0.999 |
| 0.03556 | 0.999 |
| 0.03557 | 0.999 |
| 0.03558 | 0.999 |
| 0.03559 | 0.999 |
| 0.0356 | 0.999 |
| 0.03561 | 0.999 |
| 0.03562 | 0.999 |
| 0.03563 | 0.999 |
| 0.03564 | 0.999 |
| 0.03565 | 0.999 |
| 0.03566 | 0.999 |
| 0.03567 | 0.999 |
| 0.03568 | 0.999 |
| 0.03569 | 0.999 |
| 0.0357 | 0.999 |
| 0.03571 | 0.999 |
| 0.03572 | 0.999 |
| 0.03573 | 0.999 |
| 0.03574 | 0.999 |
| 0.03575 | 0.999 |
| 0.03576 | 0.999 |
| 0.03577 | 0.999 |
| 0.03578 | 0.999 |
| 0.03579 | 0.999 |
| 0.0358 | 0.999 |
| 0.03581 | 0.999 |
| 0.03582 | 0.999 |
| 0.03583 | 0.999 |
| 0.03584 | 0.999 |
| 0.03585 | 0.999 |
| 0.03586 | 0.999 |
| 0.03587 | 0.999 |
| 0.03588 | 0.999 |
| 0.03589 | 0.999 |
| 0.0359 | 0.999 |
| 0.03591 | 0.999 |
| 0.03592 | 0.999 |
| 0.03593 | 0.999 |
| 0.03594 | 0.999 |
| 0.03595 | 0.999 |
| 0.03596 | 0.999 |
| 0.03597 | 0.999 |
| 0.03598 | 0.999 |
| 0.03599 | 0.999 |
| 0.036 | 0.999 |
| 0.03601 | 0.999 |
| 0.03602 | 0.999 |
| 0.03603 | 0.999 |
| 0.03604 | 0.999 |
| 0.03605 | 0.999 |
| 0.03606 | 0.999 |
| 0.03607 | 0.999 |
| 0.03608 | 0.999 |
| 0.03609 | 0.999 |
| 0.0361 | 0.999 |
| 0.03611 | 0.999 |
| 0.03612 | 0.999 |
| 0.03613 | 0.999 |
| 0.03614 | 0.999 |
| 0.03615 | 0.999 |
| 0.03616 | 0.999 |
| 0.03617 | 0.999 |
| 0.03618 | 0.999 |
| 0.03619 | 0.999 |
| 0.0362 | 0.999 |
| 0.03621 | 0.999 |
| 0.03622 | 0.999 |
| 0.03623 | 0.999 |
| 0.03624 | 0.999 |
| 0.03625 | 0.999 |
| 0.03626 | 0.999 |
| 0.03627 | 0.999 |
| 0.03628 | 0.999 |
| 0.03629 | 0.999 |
| 0.0363 | 0.999 |
| 0.03631 | 0.999 |
| 0.03632 | 0.999 |
| 0.03633 | 0.999 |
| 0.03634 | 0.999 |
| 0.03635 | 0.999 |
| 0.03636 | 0.999 |
| 0.03637 | 0.999 |
| 0.03638 | 0.999 |
| 0.03639 | 0.999 |
| 0.0364 | 0.999 |
| 0.03641 | 0.999 |
| 0.03642 | 0.999 |
| 0.03643 | 0.999 |
| 0.03644 | 0.999 |
| 0.03645 | 0.999 |
| 0.03646 | 0.999 |
| 0.03647 | 0.999 |
| 0.03648 | 0.999 |
| 0.03649 | 0.999 |
| 0.0365 | 0.999 |
| 0.03651 | 0.999 |
| 0.03652 | 0.999 |
| 0.03653 | 0.999 |
| 0.03654 | 0.999 |
| 0.03655 | 0.999 |
| 0.03656 | 0.999 |
| 0.03657 | 0.999 |
| 0.03658 | 0.999 |
| 0.03659 | 0.999 |
| 0.0366 | 0.999 |
| 0.03661 | 0.999 |
| 0.03662 | 0.999 |
| 0.03663 | 0.999 |
| 0.03664 | 0.999 |
| 0.03665 | 0.999 |
| 0.03666 | 0.999 |
| 0.03667 | 0.999 |
| 0.03668 | 0.999 |
| 0.03669 | 0.999 |
| 0.0367 | 0.999 |
| 0.03671 | 0.999 |
| 0.03672 | 0.999 |
| 0.03673 | 0.999 |
| 0.03674 | 0.999 |
| 0.03675 | 0.999 |
| 0.03676 | 0.999 |
| 0.03677 | 0.999 |
| 0.03678 | 0.999 |
| 0.03679 | 0.999 |
| 0.0368 | 0.999 |
| 0.03681 | 0.999 |
| 0.03682 | 0.999 |
| 0.03683 | 0.999 |
| 0.03684 | 0.999 |
| 0.03685 | 0.999 |
| 0.03686 | 0.999 |
| 0.03687 | 0.999 |
| 0.03688 | 0.999 |
| 0.03689 | 0.999 |
| 0.0369 | 0.999 |
| 0.03691 | 0.999 |
| 0.03692 | 0.999 |
| 0.03693 | 0.999 |
| 0.03694 | 0.999 |
| 0.03695 | 0.999 |
| 0.03696 | 0.999 |
| 0.03697 | 0.999 |
| 0.03698 | 0.999 |
| 0.03699 | 0.999 |
| 0.037 | 0.999 |
| 0.03701 | 0.999 |
| 0.03702 | 0.999 |
| 0.03703 | 0.999 |
| 0.03704 | 0.999 |
| 0.03705 | 0.999 |
| 0.03706 | 0.999 |
| 0.03707 | 0.999 |
| 0.03708 | 0.999 |
| 0.03709 | 0.999 |
| 0.0371 | 0.999 |
| 0.03711 | 0.999 |
| 0.03712 | 0.999 |
| 0.03713 | 0.999 |
| 0.03714 | 0.999 |
| 0.03715 | 0.999 |
| 0.03716 | 0.999 |
| 0.03717 | 0.999 |
| 0.03718 | 0.999 |
| 0.03719 | 0.999 |
| 0.0372 | 0.999 |
| 0.03721 | 0.999 |
| 0.03722 | 0.999 |
| 0.03723 | 0.999 |
| 0.03724 | 0.999 |
| 0.03725 | 0.999 |
| 0.03726 | 0.999 |
| 0.03727 | 0.999 |
| 0.03728 | 0.999 |
| 0.03729 | 0.999 |
| 0.0373 | 0.999 |
| 0.03731 | 0.999 |
| 0.03732 | 0.999 |
| 0.03733 | 0.999 |
| 0.03734 | 0.999 |
| 0.03735 | 0.999 |
| 0.03736 | 0.999 |
| 0.03737 | 0.999 |
| 0.03738 | 0.999 |
| 0.03739 | 0.999 |
| 0.0374 | 0.999 |
| 0.03741 | 0.999 |
| 0.03742 | 0.999 |
| 0.03743 | 0.999 |
| 0.03744 | 0.999 |
| 0.03745 | 0.999 |
| 0.03746 | 0.999 |
| 0.03747 | 0.999 |
| 0.03748 | 0.999 |
| 0.03749 | 0.999 |
| 0.0375 | 0.999 |
| 0.03751 | 0.999 |
| 0.03752 | 0.999 |
| 0.03753 | 0.999 |
| 0.03754 | 0.999 |
| 0.03755 | 0.999 |
| 0.03756 | 0.999 |
| 0.03757 | 0.999 |
| 0.03758 | 0.999 |
| 0.03759 | 0.999 |
| 0.0376 | 0.999 |
| 0.03761 | 0.999 |
| 0.03762 | 0.999 |
| 0.03763 | 0.999 |
| 0.03764 | 0.999 |
| 0.03765 | 0.999 |
| 0.03766 | 0.999 |
| 0.03767 | 0.999 |
| 0.03768 | 0.999 |
| 0.03769 | 0.999 |
| 0.0377 | 0.999 |
| 0.03771 | 0.999 |
| 0.03772 | 0.999 |
| 0.03773 | 0.999 |
| 0.03774 | 0.999 |
| 0.03775 | 0.999 |
| 0.03776 | 0.999 |
| 0.03777 | 0.999 |
| 0.03778 | 0.999 |
| 0.03779 | 0.999 |
| 0.0378 | 0.999 |
| 0.03781 | 0.999 |
| 0.03782 | 0.999 |
| 0.03783 | 0.999 |
| 0.03784 | 0.999 |
| 0.03785 | 0.999 |
| 0.03786 | 0.999 |
| 0.03787 | 0.999 |
| 0.03788 | 0.999 |
| 0.03789 | 0.999 |
| 0.0379 | 0.999 |
| 0.03791 | 0.999 |
| 0.03792 | 0.999 |
| 0.03793 | 0.999 |
| 0.03794 | 0.999 |
| 0.03795 | 0.999 |
| 0.03796 | 0.999 |
| 0.03797 | 0.999 |
| 0.03798 | 0.999 |
| 0.03799 | 0.999 |
| 0.038 | 0.999 |
| 0.03801 | 0.999 |
| 0.03802 | 0.999 |
| 0.03803 | 0.999 |
| 0.03804 | 0.999 |
| 0.03805 | 0.999 |
| 0.03806 | 0.999 |
| 0.03807 | 0.999 |
| 0.03808 | 0.999 |
| 0.03809 | 0.999 |
| 0.0381 | 0.999 |
| 0.03811 | 0.999 |
| 0.03812 | 0.999 |
| 0.03813 | 0.999 |
| 0.03814 | 0.999 |
| 0.03815 | 0.999 |
| 0.03816 | 0.999 |
| 0.03817 | 0.999 |
| 0.03818 | 0.999 |
| 0.03819 | 0.999 |
| 0.0382 | 0.999 |
| 0.03821 | 0.999 |
| 0.03822 | 0.999 |
| 0.03823 | 0.999 |
| 0.03824 | 0.999 |
| 0.03825 | 0.999 |
| 0.03826 | 0.999 |
| 0.03827 | 0.999 |
| 0.03828 | 0.999 |
| 0.03829 | 0.999 |
| 0.0383 | 0.999 |
| 0.03831 | 0.999 |
| 0.03832 | 0.999 |
| 0.03833 | 0.999 |
| 0.03834 | 0.999 |
| 0.03835 | 0.999 |
| 0.03836 | 1 |
| 0.03837 | 1 |
| 0.03838 | 1 |
| 0.03839 | 1 |
| 0.0384 | 1 |
| 0.03841 | 1 |
| 0.03842 | 1 |
| 0.03843 | 1 |
| 0.03844 | 1 |
| 0.03845 | 1 |
| 0.03846 | 1 |
| 0.03847 | 1 |
| 0.03848 | 1 |
| 0.03849 | 1 |
| 0.0385 | 1 |
| 0.03851 | 1 |
| 0.03852 | 1 |
| 0.03853 | 1 |
| 0.03854 | 1 |
| 0.03855 | 1 |
| 0.03856 | 1 |
| 0.03857 | 1 |
| 0.03858 | 1 |
| 0.03859 | 1 |
| 0.0386 | 1 |
| 0.03861 | 1 |
| 0.03862 | 1 |
| 0.03863 | 1 |
| 0.03864 | 1 |
| 0.03865 | 1 |
| 0.03866 | 1 |
| 0.03867 | 1 |
| 0.03868 | 1 |
| 0.03869 | 1 |
| 0.0387 | 1 |
| 0.03871 | 1 |
| 0.03872 | 1 |
| 0.03873 | 1 |
| 0.03874 | 1 |
| 0.03875 | 1 |
| 0.03876 | 1 |
| 0.03877 | 1 |
| 0.03878 | 1 |
| 0.03879 | 1 |
| 0.0388 | 1 |
| 0.03881 | 1 |
| 0.03882 | 1 |
| 0.03883 | 1 |
| 0.03884 | 1 |
| 0.03885 | 1 |
| 0.03886 | 1 |
| 0.03887 | 1 |
| 0.03888 | 1 |
| 0.03889 | 1 |
| 0.0389 | 1 |
| 0.03891 | 1 |
| 0.03892 | 1 |
| 0.03893 | 1 |
| 0.03894 | 1 |
| 0.03895 | 1 |
| 0.03896 | 1 |
| 0.03897 | 1 |
| 0.03898 | 1 |
| 0.03899 | 1 |
| 0.039 | 1 |
| 0.03901 | 1 |
| 0.03902 | 1 |
| 0.03903 | 1 |
| 0.03904 | 1 |
| 0.03905 | 1 |
| 0.03906 | 1 |
| 0.03907 | 1 |
| 0.03908 | 1 |
| 0.03909 | 1 |
| 0.0391 | 1 |
| 0.03911 | 1 |
| 0.03912 | 1 |
| 0.03913 | 1 |
| 0.03914 | 1 |
| 0.03915 | 1 |
| 0.03916 | 1 |
| 0.03917 | 1 |
| 0.03918 | 1 |
| 0.03919 | 1 |
| 0.0392 | 1 |
| 0.03921 | 1 |
| 0.03922 | 1 |
| 0.03923 | 1 |
| 0.03924 | 1 |
| 0.03925 | 1 |
| 0.03926 | 1 |
| 0.03927 | 1 |
| 0.03928 | 1 |
| 0.03929 | 1 |
| 0.0393 | 1 |
| 0.03931 | 1 |
| 0.03932 | 1 |
| 0.03933 | 1 |
| 0.03934 | 1 |
| 0.03935 | 1 |
| 0.03936 | 1 |
| 0.03937 | 1 |
| 0.03938 | 1 |
| 0.03939 | 1 |
| 0.0394 | 1 |
| 0.03941 | 1 |
| 0.03942 | 1 |
| 0.03943 | 1 |
| 0.03944 | 1 |
| 0.03945 | 1 |
| 0.03946 | 1 |
| 0.03947 | 1 |
| 0.03948 | 1 |
| 0.03949 | 1 |
| 0.0395 | 1 |
| 0.03951 | 1 |
| 0.03952 | 1 |
| 0.03953 | 1 |
| 0.03954 | 1 |
| 0.03955 | 1 |
| 0.03956 | 1 |
| 0.03957 | 1 |
| 0.03958 | 1 |
| 0.03959 | 1 |
| 0.0396 | 1 |
| 0.03961 | 1 |
| 0.03962 | 1 |
| 0.03963 | 1 |
| 0.03964 | 1 |
| 0.03965 | 1 |
| 0.03966 | 1 |
| 0.03967 | 1 |
| 0.03968 | 1 |
| 0.03969 | 1 |
| 0.0397 | 1 |
| 0.03971 | 1 |
| 0.03972 | 1 |
| 0.03973 | 1 |
| 0.03974 | 1 |
| 0.03975 | 1 |
| 0.03976 | 1 |
| 0.03977 | 1 |
| 0.03978 | 1 |
| 0.03979 | 1 |
| 0.0398 | 1 |
| 0.03981 | 1 |
| 0.03982 | 1 |
| 0.03983 | 1 |
| 0.03984 | 1 |
| 0.03985 | 1 |
| 0.03986 | 1 |
| 0.03987 | 1 |
| 0.03988 | 1 |
| 0.03989 | 1 |
| 0.0399 | 1 |
| 0.03991 | 1 |
| 0.03992 | 1 |
| 0.03993 | 1 |
| 0.03994 | 1 |
| 0.03995 | 1 |
| 0.03996 | 1 |
| 0.03997 | 1 |
| 0.03998 | 1 |
| 0.03999 | 1 |
| 0.04 | 1 |
| 0.04001 | 1 |
| 0.04002 | 1 |
| 0.04003 | 1 |
| 0.04004 | 1 |
| 0.04005 | 1 |
| 0.04006 | 1 |
| 0.04007 | 1 |
| 0.04008 | 1 |
| 0.04009 | 1 |
| 0.0401 | 1 |
| 0.04011 | 1 |
| 0.04012 | 1 |
| 0.04013 | 1 |
| 0.04014 | 1 |
| 0.04015 | 1 |
| 0.04016 | 1 |
| 0.04017 | 1 |
| 0.04018 | 1 |
| 0.04019 | 1 |
| 0.0402 | 1 |
| 0.04021 | 1 |
| 0.04022 | 1 |
| 0.04023 | 1 |
| 0.04024 | 1 |
| 0.04025 | 1 |
| 0.04026 | 1 |
| 0.04027 | 1 |
| 0.04028 | 1 |
| 0.04029 | 1 |
| 0.0403 | 1 |
| 0.04031 | 1 |
| 0.04032 | 1 |
| 0.04033 | 1 |
| 0.04034 | 1 |
| 0.04035 | 1 |
| 0.04036 | 1 |
| 0.04037 | 1 |
| 0.04038 | 1 |
| 0.04039 | 1 |
| 0.0404 | 1 |
| 0.04041 | 1 |
| 0.04042 | 1 |
| 0.04043 | 1 |
| 0.04044 | 1 |
| 0.04045 | 1 |
| 0.04046 | 1 |
| 0.04047 | 1 |
| 0.04048 | 1 |
| 0.04049 | 1 |
| 0.0405 | 1 |
| 0.04051 | 1 |
| 0.04052 | 1 |
| 0.04053 | 1 |
| 0.04054 | 1 |
| 0.04055 | 1 |
| 0.04056 | 1 |
| 0.04057 | 1 |
| 0.04058 | 1 |
| 0.04059 | 1 |
| 0.0406 | 1 |
| 0.04061 | 1 |
| 0.04062 | 1 |
| 0.04063 | 1 |
| 0.04064 | 1 |
| 0.04065 | 1 |
| 0.04066 | 1 |
| 0.04067 | 1 |
| 0.04068 | 1 |
| 0.04069 | 1 |
| 0.0407 | 1 |
| 0.04071 | 1 |
| 0.04072 | 1 |
| 0.04073 | 1 |
| 0.04074 | 1 |
| 0.04075 | 1 |
| 0.04076 | 1 |
| 0.04077 | 1 |
| 0.04078 | 1 |
| 0.04079 | 1 |
| 0.0408 | 1 |
| 0.04081 | 1 |
| 0.04082 | 1 |
| 0.04083 | 1 |
| 0.04084 | 1 |
| 0.04085 | 1 |
| 0.04086 | 1 |
| 0.04087 | 1 |
| 0.04088 | 1 |
| 0.04089 | 1 |
| 0.0409 | 1 |
| 0.04091 | 1 |
| 0.04092 | 1 |
| 0.04093 | 1 |
| 0.04094 | 1 |
| 0.04095 | 1 |
| 0.04096 | 1 |
| 0.04097 | 1 |
| 0.04098 | 1 |
| 0.04099 | 1 |
| 0.041 | 1 |
| 0.04101 | 1 |
| 0.04102 | 1 |
| 0.04103 | 1 |
| 0.04104 | 1 |
| 0.04105 | 1 |
| 0.04106 | 1 |
| 0.04107 | 1 |
| 0.04108 | 1 |
| 0.04109 | 1 |
| 0.0411 | 1 |
| 0.04111 | 1 |
| 0.04112 | 1 |
| 0.04113 | 1 |
| 0.04114 | 1 |
| 0.04115 | 1 |
| 0.04116 | 1 |
| 0.04117 | 1 |
| 0.04118 | 1 |
| 0.04119 | 1 |
| 0.0412 | 1 |
| 0.04121 | 1 |
| 0.04122 | 1 |
| 0.04123 | 1 |
| 0.04124 | 1 |
| 0.04125 | 1 |
| 0.04126 | 1 |
| 0.04127 | 1 |
| 0.04128 | 1 |
| 0.04129 | 1 |
| 0.0413 | 1 |
| 0.04131 | 1 |
| 0.04132 | 1 |
| 0.04133 | 1 |
| 0.04134 | 1 |
| 0.04135 | 1 |
| 0.04136 | 1 |
| 0.04137 | 1 |
| 0.04138 | 1 |
| 0.04139 | 1 |
| 0.0414 | 1 |
| 0.04141 | 1 |
| 0.04142 | 1 |
| 0.04143 | 1 |
| 0.04144 | 1 |
| 0.04145 | 1 |
| 0.04146 | 1 |
| 0.04147 | 1 |
| 0.04148 | 1 |
| 0.04149 | 1 |
| 0.0415 | 1 |
| 0.04151 | 1 |
| 0.04152 | 1 |
| 0.04153 | 1 |
| 0.04154 | 1 |
| 0.04155 | 1 |
| 0.04156 | 1 |
| 0.04157 | 1 |
| 0.04158 | 1 |
| 0.04159 | 1 |
| 0.0416 | 1 |
| 0.04161 | 1 |
| 0.04162 | 1 |
| 0.04163 | 1 |
| 0.04164 | 1 |
| 0.04165 | 1 |
| 0.04166 | 1 |
| 0.04167 | 1 |
| 0.04168 | 1 |
| 0.04169 | 1 |
| 0.0417 | 1 |
| 0.04171 | 1 |
| 0.04172 | 1 |
| 0.04173 | 1 |
| 0.04174 | 1 |
| 0.04175 | 1 |
| 0.04176 | 1 |
| 0.04177 | 1 |
| 0.04178 | 1 |
| 0.04179 | 1 |
| 0.0418 | 1 |
| 0.04181 | 1 |
| 0.04182 | 1 |
| 0.04183 | 1 |
| 0.04184 | 1 |
| 0.04185 | 1 |
| 0.04186 | 1 |
| 0.04187 | 1 |
| 0.04188 | 1 |
| 0.04189 | 1 |
| 0.0419 | 1 |
| 0.04191 | 1 |
| 0.04192 | 1 |
| 0.04193 | 1 |
| 0.04194 | 1 |
| 0.04195 | 1 |
| 0.04196 | 1 |
| 0.04197 | 1 |
| 0.04198 | 1 |
| 0.04199 | 1 |
| 0.042 | 1 |
| 0.04201 | 1 |
| 0.04202 | 1 |
| 0.04203 | 1 |
| 0.04204 | 1 |
| 0.04205 | 1 |
| 0.04206 | 1 |
| 0.04207 | 1 |
| 0.04208 | 1 |
| 0.04209 | 1 |
| 0.0421 | 1 |
| 0.04211 | 1 |
| 0.04212 | 1 |
| 0.04213 | 1 |
| 0.04214 | 1 |
| 0.04215 | 1 |
| 0.04216 | 1 |
| 0.04217 | 1 |
| 0.04218 | 1 |
| 0.04219 | 1 |
| 0.0422 | 1 |
| 0.04221 | 1 |
| 0.04222 | 1 |
| 0.04223 | 1 |
| 0.04224 | 1 |
| 0.04225 | 1 |
| 0.04226 | 1 |
| 0.04227 | 1 |
| 0.04228 | 1 |
| 0.04229 | 1 |
| 0.0423 | 1 |
| 0.04231 | 1 |
| 0.04232 | 1 |
| 0.04233 | 1 |
| 0.04234 | 1 |
| 0.04235 | 1 |
| 0.04236 | 1 |
| 0.04237 | 1 |
| 0.04238 | 1 |
| 0.04239 | 1 |
| 0.0424 | 1 |
| 0.04241 | 1 |
| 0.04242 | 1 |
| 0.04243 | 1 |
| 0.04244 | 1 |
| 0.04245 | 1 |
| 0.04246 | 1 |
| 0.04247 | 1 |
| 0.04248 | 1 |
| 0.04249 | 1 |
| 0.0425 | 1 |
| 0.04251 | 1 |
| 0.04252 | 1 |
| 0.04253 | 1 |
| 0.04254 | 1 |
| 0.04255 | 1 |
| 0.04256 | 1 |
| 0.04257 | 1 |
| 0.04258 | 1 |
| 0.04259 | 1 |
| 0.0426 | 1 |
| 0.04261 | 1 |
| 0.04262 | 1 |
| 0.04263 | 1 |
| 0.04264 | 1 |
| 0.04265 | 1 |
| 0.04266 | 1 |
| 0.04267 | 1 |
| 0.04268 | 1 |
| 0.04269 | 1 |
| 0.0427 | 1 |
| 0.04271 | 1 |
| 0.04272 | 1 |
| 0.04273 | 1 |
| 0.04274 | 1 |
| 0.04275 | 1 |
| 0.04276 | 1 |
| 0.04277 | 1 |
| 0.04278 | 1 |
| 0.04279 | 1 |
| 0.0428 | 1 |
| 0.04281 | 1 |
| 0.04282 | 1 |
| 0.04283 | 1 |
| 0.04284 | 1 |
| 0.04285 | 1 |
| 0.04286 | 1 |
| 0.04287 | 1 |
| 0.04288 | 1 |
| 0.04289 | 1 |
| 0.0429 | 1 |
| 0.04291 | 1 |
| 0.04292 | 1 |
| 0.04293 | 1 |
| 0.04294 | 1 |
| 0.04295 | 1 |
| 0.04296 | 1 |
| 0.04297 | 1 |
| 0.04298 | 1 |
| 0.04299 | 1 |
| 0.043 | 1 |
| 0.04301 | 1 |
| 0.04302 | 1 |
| 0.04303 | 1 |
| 0.04304 | 1 |
| 0.04305 | 1 |
| 0.04306 | 1 |
| 0.04307 | 1 |
| 0.04308 | 1 |
| 0.04309 | 1 |
| 0.0431 | 1 |
| 0.04311 | 1 |
| 0.04312 | 1 |
| 0.04313 | 1 |
| 0.04314 | 1 |
| 0.04315 | 1 |
| 0.04316 | 1 |
| 0.04317 | 1 |
| 0.04318 | 1 |
| 0.04319 | 1 |
| 0.0432 | 1 |
| 0.04321 | 1 |
| 0.04322 | 1 |
| 0.04323 | 1 |
| 0.04324 | 1 |
| 0.04325 | 1 |
| 0.04326 | 1 |
| 0.04327 | 1 |
| 0.04328 | 1 |
| 0.04329 | 1 |
| 0.0433 | 1 |
| 0.04331 | 1 |
| 0.04332 | 1 |
| 0.04333 | 1 |
| 0.04334 | 1 |
| 0.04335 | 1 |
| 0.04336 | 1 |
| 0.04337 | 1 |
| 0.04338 | 1 |
| 0.04339 | 1 |
| 0.0434 | 1 |
| 0.04341 | 1 |
| 0.04342 | 1 |
| 0.04343 | 1 |
| 0.04344 | 1 |
| 0.04345 | 1 |
| 0.04346 | 1 |
| 0.04347 | 1 |
| 0.04348 | 1 |
| 0.04349 | 1 |
| 0.0435 | 1 |
| 0.04351 | 1 |
| 0.04352 | 1 |
| 0.04353 | 1 |
| 0.04354 | 1 |
| 0.04355 | 1 |
| 0.04356 | 1 |
| 0.04357 | 1 |
| 0.04358 | 1 |
| 0.04359 | 1 |
| 0.0436 | 1 |
| 0.04361 | 1 |
| 0.04362 | 1 |
| 0.04363 | 1 |
| 0.04364 | 1 |
| 0.04365 | 1 |
| 0.04366 | 1 |
| 0.04367 | 1 |
| 0.04368 | 1 |
| 0.04369 | 1 |
| 0.0437 | 1 |
| 0.04371 | 1 |
| 0.04372 | 1 |
| 0.04373 | 1 |
| 0.04374 | 1 |
| 0.04375 | 1 |
| 0.04376 | 1 |
| 0.04377 | 1 |
| 0.04378 | 1 |
| 0.04379 | 1 |
| 0.0438 | 1 |
| 0.04381 | 1 |
| 0.04382 | 1 |
| 0.04383 | 1 |
| 0.04384 | 1 |
| 0.04385 | 1 |
| 0.04386 | 1 |
| 0.04387 | 1 |
| 0.04388 | 1 |
| 0.04389 | 1 |
| 0.0439 | 1 |
| 0.04391 | 1 |
| 0.04392 | 1 |
| 0.04393 | 1 |
| 0.04394 | 1 |
| 0.04395 | 1 |
| 0.04396 | 1 |
| 0.04397 | 1 |
| 0.04398 | 1 |
| 0.04399 | 1 |
| 0.044 | 1 |
| 0.04401 | 1 |
| 0.04402 | 1 |
| 0.04403 | 1 |
| 0.04404 | 1 |
| 0.04405 | 1 |
| 0.04406 | 1 |
| 0.04407 | 1 |
| 0.04408 | 1 |
| 0.04409 | 1 |
| 0.0441 | 1 |
| 0.04411 | 1 |
| 0.04412 | 1 |
| 0.04413 | 1 |
| 0.04414 | 1 |
| 0.04415 | 1 |
| 0.04416 | 1 |
| 0.04417 | 1 |
| 0.04418 | 1 |
| 0.04419 | 1 |
| 0.0442 | 1 |
| 0.04421 | 1 |
| 0.04422 | 1 |
| 0.04423 | 1 |
| 0.04424 | 1 |
| 0.04425 | 1 |
| 0.04426 | 1 |
| 0.04427 | 1 |
| 0.04428 | 1 |
| 0.04429 | 1 |
| 0.0443 | 1 |
| 0.04431 | 1 |
| 0.04432 | 1 |
| 0.04433 | 1 |
| 0.04434 | 1 |
| 0.04435 | 1 |
| 0.04436 | 1 |
| 0.04437 | 1 |
| 0.04438 | 1 |
| 0.04439 | 1 |
| 0.0444 | 1 |
| 0.04441 | 1 |
| 0.04442 | 1 |
| 0.04443 | 1 |
| 0.04444 | 1 |
| 0.04445 | 1 |
| 0.04446 | 1 |
| 0.04447 | 1 |
| 0.04448 | 1 |
| 0.04449 | 1 |
| 0.0445 | 1 |
| 0.04451 | 1 |
| 0.04452 | 1 |
| 0.04453 | 1 |
| 0.04454 | 1 |
| 0.04455 | 1 |
| 0.04456 | 1 |
| 0.04457 | 1 |
| 0.04458 | 1 |
| 0.04459 | 1 |
| 0.0446 | 1 |
| 0.04461 | 1 |
| 0.04462 | 1 |
| 0.04463 | 1 |
| 0.04464 | 1 |
| 0.04465 | 1 |
| 0.04466 | 1 |
| 0.04467 | 1 |
| 0.04468 | 1 |
| 0.04469 | 1 |
| 0.0447 | 1 |
| 0.04471 | 1 |
| 0.04472 | 1 |
| 0.04473 | 1 |
| 0.04474 | 1 |
| 0.04475 | 1 |
| 0.04476 | 1 |
| 0.04477 | 1 |
| 0.04478 | 1 |
| 0.04479 | 1 |
| 0.0448 | 1 |
| 0.04481 | 1 |
| 0.04482 | 1 |
| 0.04483 | 1 |
| 0.04484 | 1 |
| 0.04485 | 1 |
| 0.04486 | 1 |
| 0.04487 | 1 |
| 0.04488 | 1 |
| 0.04489 | 1 |
| 0.0449 | 1 |
| 0.04491 | 1 |
| 0.04492 | 1 |
| 0.04493 | 1 |
| 0.04494 | 1 |
| 0.04495 | 1 |
| 0.04496 | 1 |
| 0.04497 | 1 |
| 0.04498 | 1 |
| 0.04499 | 1 |
| 0.045 | 1 |
| 0.04501 | 1 |
| 0.04502 | 1 |
| 0.04503 | 1 |
| 0.04504 | 1 |
| 0.04505 | 1 |
| 0.04506 | 1 |
| 0.04507 | 1 |
| 0.04508 | 1 |
| 0.04509 | 1 |
| 0.0451 | 1 |
| 0.04511 | 1 |
| 0.04512 | 1 |
| 0.04513 | 1 |
| 0.04514 | 1 |
| 0.04515 | 1 |
| 0.04516 | 1 |
| 0.04517 | 1 |
| 0.04518 | 1 |
| 0.04519 | 1 |
| 0.0452 | 1 |
| 0.04521 | 1 |
| 0.04522 | 1 |
| 0.04523 | 1 |
| 0.04524 | 1 |
| 0.04525 | 1 |
| 0.04526 | 1 |
| 0.04527 | 1 |
| 0.04528 | 1 |
| 0.04529 | 1 |
| 0.0453 | 1 |
| 0.04531 | 1 |
| 0.04532 | 1 |
| 0.04533 | 1 |
| 0.04534 | 1 |
| 0.04535 | 1 |
| 0.04536 | 1 |
| 0.04537 | 1 |
| 0.04538 | 1 |
| 0.04539 | 1 |
| 0.0454 | 1 |
| 0.04541 | 1 |
| 0.04542 | 1 |
| 0.04543 | 1 |
| 0.04544 | 1 |
| 0.04545 | 1 |
| 0.04546 | 1 |
| 0.04547 | 1 |
| 0.04548 | 1 |
| 0.04549 | 1 |
| 0.0455 | 1 |
| 0.04551 | 1 |
| 0.04552 | 1 |
| 0.04553 | 1 |
| 0.04554 | 1 |
| 0.04555 | 1 |
| 0.04556 | 1 |
| 0.04557 | 1 |
| 0.04558 | 1 |
| 0.04559 | 1 |
| 0.0456 | 1 |
| 0.04561 | 1 |
| 0.04562 | 1 |
| 0.04563 | 1 |
| 0.04564 | 1 |
| 0.04565 | 1 |
| 0.04566 | 1 |
| 0.04567 | 1 |
| 0.04568 | 1 |
| 0.04569 | 1 |
| 0.0457 | 1 |
| 0.04571 | 1 |
| 0.04572 | 1 |
| 0.04573 | 1 |
| 0.04574 | 1 |
| 0.04575 | 1 |
| 0.04576 | 1 |
| 0.04577 | 1 |
| 0.04578 | 1 |
| 0.04579 | 1 |
| 0.0458 | 1 |
| 0.04581 | 1 |
| 0.04582 | 1 |
| 0.04583 | 1 |
| 0.04584 | 1 |
| 0.04585 | 1 |
| 0.04586 | 1 |
| 0.04587 | 1 |
| 0.04588 | 1 |
| 0.04589 | 1 |
| 0.0459 | 1 |
| 0.04591 | 1 |
| 0.04592 | 1 |
| 0.04593 | 1 |
| 0.04594 | 1 |
| 0.04595 | 1 |
| 0.04596 | 1 |
| 0.04597 | 1 |
| 0.04598 | 1 |
| 0.04599 | 1 |
| 0.046 | 1 |
| 0.04601 | 1 |
| 0.04602 | 1 |
| 0.04603 | 1 |
| 0.04604 | 1 |
| 0.04605 | 1 |
| 0.04606 | 1 |
| 0.04607 | 1 |
| 0.04608 | 1 |
| 0.04609 | 1 |
| 0.0461 | 1 |
| 0.04611 | 1 |
| 0.04612 | 1 |
| 0.04613 | 1 |
| 0.04614 | 1 |
| 0.04615 | 1 |
| 0.04616 | 1 |
| 0.04617 | 1 |
| 0.04618 | 1 |
| 0.04619 | 1 |
| 0.0462 | 1 |
| 0.04621 | 1 |
| 0.04622 | 1 |
| 0.04623 | 1 |
| 0.04624 | 1 |
| 0.04625 | 1 |
| 0.04626 | 1 |
| 0.04627 | 1 |
| 0.04628 | 1 |
| 0.04629 | 1 |
| 0.0463 | 1 |
| 0.04631 | 1 |
| 0.04632 | 1 |
| 0.04633 | 1 |
| 0.04634 | 1 |
| 0.04635 | 1 |
| 0.04636 | 1 |
| 0.04637 | 1 |
| 0.04638 | 1 |
| 0.04639 | 1 |
| 0.0464 | 1 |
| 0.04641 | 1 |
| 0.04642 | 1 |
| 0.04643 | 1 |
| 0.04644 | 1 |
| 0.04645 | 1 |
| 0.04646 | 1 |
| 0.04647 | 1 |
| 0.04648 | 1 |
| 0.04649 | 1 |
| 0.0465 | 1 |
| 0.04651 | 1 |
| 0.04652 | 1 |
| 0.04653 | 1 |
| 0.04654 | 1 |
| 0.04655 | 1 |
| 0.04656 | 1 |
| 0.04657 | 1 |
| 0.04658 | 1 |
| 0.04659 | 1 |
| 0.0466 | 1 |
| 0.04661 | 1 |
| 0.04662 | 1 |
| 0.04663 | 1 |
| 0.04664 | 1 |
| 0.04665 | 1 |
| 0.04666 | 1 |
| 0.04667 | 1 |
| 0.04668 | 1 |
| 0.04669 | 1 |
| 0.0467 | 1 |
| 0.04671 | 1 |
| 0.04672 | 1 |
| 0.04673 | 1 |
| 0.04674 | 1 |
| 0.04675 | 1 |
| 0.04676 | 1 |
| 0.04677 | 1 |
| 0.04678 | 1 |
| 0.04679 | 1 |
| 0.0468 | 1 |
| 0.04681 | 1 |
| 0.04682 | 1 |
| 0.04683 | 1 |
| 0.04684 | 1 |
| 0.04685 | 1 |
| 0.04686 | 1 |
| 0.04687 | 1 |
| 0.04688 | 1 |
| 0.04689 | 1 |
| 0.0469 | 1 |
| 0.04691 | 1 |
| 0.04692 | 1 |
| 0.04693 | 1 |
| 0.04694 | 1 |
| 0.04695 | 1 |
| 0.04696 | 1 |
| 0.04697 | 1 |
| 0.04698 | 1 |
| 0.04699 | 1 |
| 0.047 | 1 |
| 0.04701 | 1 |
| 0.04702 | 1 |
| 0.04703 | 1 |
| 0.04704 | 1 |
| 0.04705 | 1 |
| 0.04706 | 1 |
| 0.04707 | 1 |
| 0.04708 | 1 |
| 0.04709 | 1 |
| 0.0471 | 1 |
| 0.04711 | 1 |
| 0.04712 | 1 |
| 0.04713 | 1 |
| 0.04714 | 1 |
| 0.04715 | 1 |
| 0.04716 | 1 |
| 0.04717 | 1 |
| 0.04718 | 1 |
| 0.04719 | 1 |
| 0.0472 | 1 |
| 0.04721 | 1 |
| 0.04722 | 1 |
| 0.04723 | 1 |
| 0.04724 | 1 |
| 0.04725 | 1 |
| 0.04726 | 1 |
| 0.04727 | 1 |
| 0.04728 | 1 |
| 0.04729 | 1 |
| 0.0473 | 1 |
| 0.04731 | 1 |
| 0.04732 | 1 |
| 0.04733 | 1 |
| 0.04734 | 1 |
| 0.04735 | 1 |
| 0.04736 | 1 |
| 0.04737 | 1 |
| 0.04738 | 1 |
| 0.04739 | 1 |
| 0.0474 | 1 |
| 0.04741 | 1 |
| 0.04742 | 1 |
| 0.04743 | 1 |
| 0.04744 | 1 |
| 0.04745 | 1 |
| 0.04746 | 1 |
| 0.04747 | 1 |
| 0.04748 | 1 |
| 0.04749 | 1 |
| 0.0475 | 1 |
| 0.04751 | 1 |
| 0.04752 | 1 |
| 0.04753 | 1 |
| 0.04754 | 1 |
| 0.04755 | 1 |
| 0.04756 | 1 |
| 0.04757 | 1 |
| 0.04758 | 1 |
| 0.04759 | 1 |
| 0.0476 | 1 |
| 0.04761 | 1 |
| 0.04762 | 1 |
| 0.04763 | 1 |
| 0.04764 | 1 |
| 0.04765 | 1 |
| 0.04766 | 1 |
| 0.04767 | 1 |
| 0.04768 | 1 |
| 0.04769 | 1 |
| 0.0477 | 1 |
| 0.04771 | 1 |
| 0.04772 | 1 |
| 0.04773 | 1 |
| 0.04774 | 1 |
| 0.04775 | 1 |
| 0.04776 | 1 |
| 0.04777 | 1 |
| 0.04778 | 1 |
| 0.04779 | 1 |
| 0.0478 | 1 |
| 0.04781 | 1 |
| 0.04782 | 1 |
| 0.04783 | 1 |
| 0.04784 | 1 |
| 0.04785 | 1 |
| 0.04786 | 1 |
| 0.04787 | 1 |
| 0.04788 | 1 |
| 0.04789 | 1 |
| 0.0479 | 1 |
| 0.04791 | 1 |
| 0.04792 | 1 |
| 0.04793 | 1 |
| 0.04794 | 1 |
| 0.04795 | 1 |
| 0.04796 | 1 |
| 0.04797 | 1 |
| 0.04798 | 1 |
| 0.04799 | 1 |
| 0.048 | 1 |
| 0.04801 | 1 |
| 0.04802 | 1 |
| 0.04803 | 1 |
| 0.04804 | 1 |
| 0.04805 | 1 |
| 0.04806 | 1 |
| 0.04807 | 1 |
| 0.04808 | 1 |
| 0.04809 | 1 |
| 0.0481 | 1 |
| 0.04811 | 1 |
| 0.04812 | 1 |
| 0.04813 | 1 |
| 0.04814 | 1 |
| 0.04815 | 1 |
| 0.04816 | 1 |
| 0.04817 | 1 |
| 0.04818 | 1 |
| 0.04819 | 1 |
| 0.0482 | 1 |
| 0.04821 | 1 |
| 0.04822 | 1 |
| 0.04823 | 1 |
| 0.04824 | 1 |
| 0.04825 | 1 |
| 0.04826 | 1 |
| 0.04827 | 1 |
| 0.04828 | 1 |
| 0.04829 | 1 |
| 0.0483 | 1 |
| 0.04831 | 1 |
| 0.04832 | 1 |
| 0.04833 | 1 |
| 0.04834 | 1 |
| 0.04835 | 1 |
| 0.04836 | 1 |
| 0.04837 | 1 |
| 0.04838 | 1 |
| 0.04839 | 1 |
| 0.0484 | 1 |
| 0.04841 | 1 |
| 0.04842 | 1 |
| 0.04843 | 1 |
| 0.04844 | 1 |
| 0.04845 | 1 |
| 0.04846 | 1 |
| 0.04847 | 1 |
| 0.04848 | 1 |
| 0.04849 | 1 |
| 0.0485 | 1 |
| 0.04851 | 1 |
| 0.04852 | 1 |
| 0.04853 | 1 |
| 0.04854 | 1 |
| 0.04855 | 1 |
| 0.04856 | 1 |
| 0.04857 | 1 |
| 0.04858 | 1 |
| 0.04859 | 1 |
| 0.0486 | 1 |
| 0.04861 | 1 |
| 0.04862 | 1 |
| 0.04863 | 1 |
| 0.04864 | 1 |
| 0.04865 | 1 |
| 0.04866 | 1 |
| 0.04867 | 1 |
| 0.04868 | 1 |
| 0.04869 | 1 |
| 0.0487 | 1 |
| 0.04871 | 1 |
| 0.04872 | 1 |
| 0.04873 | 1 |
| 0.04874 | 1 |
| 0.04875 | 1 |
| 0.04876 | 1 |
| 0.04877 | 1 |
| 0.04878 | 1 |
| 0.04879 | 1 |
| 0.0488 | 1 |
| 0.04881 | 1 |
| 0.04882 | 1 |
| 0.04883 | 1 |
| 0.04884 | 1 |
| 0.04885 | 1 |
| 0.04886 | 1 |
| 0.04887 | 1 |
| 0.04888 | 1 |
| 0.04889 | 1 |
| 0.0489 | 1 |
| 0.04891 | 1 |
| 0.04892 | 1 |
| 0.04893 | 1 |
| 0.04894 | 1 |
| 0.04895 | 1 |
| 0.04896 | 1 |
| 0.04897 | 1 |
| 0.04898 | 1 |
| 0.04899 | 1 |
| 0.049 | 1 |
| 0.04901 | 1 |
| 0.04902 | 1 |
| 0.04903 | 1 |
| 0.04904 | 1 |
| 0.04905 | 1 |
| 0.04906 | 1 |
| 0.04907 | 1 |
| 0.04908 | 1 |
| 0.04909 | 1 |
| 0.0491 | 1 |
| 0.04911 | 1 |
| 0.04912 | 1 |
| 0.04913 | 1 |
| 0.04914 | 1 |
| 0.04915 | 1 |
| 0.04916 | 1 |
| 0.04917 | 1 |
| 0.04918 | 1 |
| 0.04919 | 1 |
| 0.0492 | 1 |
| 0.04921 | 0.999 |
| 0.04922 | 0.999 |
| 0.04923 | 0.999 |
| 0.04924 | 0.999 |
| 0.04925 | 0.999 |
| 0.04926 | 0.999 |
| 0.04927 | 0.999 |
| 0.04928 | 0.999 |
| 0.04929 | 0.999 |
| 0.0493 | 0.999 |
| 0.04931 | 0.999 |
| 0.04932 | 0.999 |
| 0.04933 | 0.999 |
| 0.04934 | 0.999 |
| 0.04935 | 0.999 |
| 0.04936 | 0.999 |
| 0.04937 | 0.999 |
| 0.04938 | 0.999 |
| 0.04939 | 0.999 |
| 0.0494 | 0.999 |
| 0.04941 | 0.999 |
| 0.04942 | 0.999 |
| 0.04943 | 0.999 |
| 0.04944 | 0.999 |
| 0.04945 | 0.999 |
| 0.04946 | 0.999 |
| 0.04947 | 0.999 |
| 0.04948 | 0.999 |
| 0.04949 | 0.999 |
| 0.0495 | 0.999 |
| 0.04951 | 0.999 |
| 0.04952 | 0.999 |
| 0.04953 | 0.999 |
| 0.04954 | 0.999 |
| 0.04955 | 0.999 |
| 0.04956 | 0.999 |
| 0.04957 | 0.999 |
| 0.04958 | 0.999 |
| 0.04959 | 0.999 |
| 0.0496 | 0.999 |
| 0.04961 | 0.999 |
| 0.04962 | 0.999 |
| 0.04963 | 0.999 |
| 0.04964 | 0.999 |
| 0.04965 | 0.999 |
| 0.04966 | 0.999 |
| 0.04967 | 0.999 |
| 0.04968 | 0.999 |
| 0.04969 | 0.999 |
| 0.0497 | 0.999 |
| 0.04971 | 0.999 |
| 0.04972 | 0.999 |
| 0.04973 | 0.999 |
| 0.04974 | 0.999 |
| 0.04975 | 0.999 |
| 0.04976 | 0.999 |
| 0.04977 | 0.999 |
| 0.04978 | 0.999 |
| 0.04979 | 0.999 |
| 0.0498 | 0.999 |
| 0.04981 | 0.999 |
| 0.04982 | 0.999 |
| 0.04983 | 0.999 |
| 0.04984 | 0.999 |
| 0.04985 | 0.999 |
| 0.04986 | 0.999 |
| 0.04987 | 0.999 |
| 0.04988 | 0.999 |
| 0.04989 | 0.999 |
| 0.0499 | 0.999 |
| 0.04991 | 0.999 |
| 0.04992 | 0.999 |
| 0.04993 | 0.999 |
| 0.04994 | 0.999 |
| 0.04995 | 0.999 |
| 0.04996 | 0.999 |
| 0.04997 | 0.999 |
| 0.04998 | 0.999 |
| 0.04999 | 0.999 |
| 0.05 | 0.999 |
| 0.05001 | 0.999 |
| 0.05002 | 0.999 |
| 0.05003 | 0.999 |
| 0.05004 | 0.999 |
| 0.05005 | 0.999 |
| 0.05006 | 0.999 |
| 0.05007 | 0.999 |
| 0.05008 | 0.999 |
| 0.05009 | 0.999 |
| 0.0501 | 0.999 |
| 0.05011 | 0.999 |
| 0.05012 | 0.999 |
| 0.05013 | 0.999 |
| 0.05014 | 0.999 |
| 0.05015 | 0.999 |
| 0.05016 | 0.999 |
| 0.05017 | 0.999 |
| 0.05018 | 0.999 |
| 0.05019 | 0.999 |
| 0.0502 | 0.999 |
| 0.05021 | 0.999 |
| 0.05022 | 0.999 |
| 0.05023 | 0.999 |
| 0.05024 | 0.999 |
| 0.05025 | 0.999 |
| 0.05026 | 0.999 |
| 0.05027 | 0.999 |
| 0.05028 | 0.999 |
| 0.05029 | 0.999 |
| 0.0503 | 0.999 |
| 0.05031 | 0.999 |
| 0.05032 | 0.999 |
| 0.05033 | 0.999 |
| 0.05034 | 0.999 |
| 0.05035 | 0.999 |
| 0.05036 | 0.999 |
| 0.05037 | 0.999 |
| 0.05038 | 0.999 |
| 0.05039 | 0.999 |
| 0.0504 | 0.999 |
| 0.05041 | 0.999 |
| 0.05042 | 0.999 |
| 0.05043 | 0.999 |
| 0.05044 | 0.999 |
| 0.05045 | 0.999 |
| 0.05046 | 0.999 |
| 0.05047 | 0.999 |
| 0.05048 | 0.999 |
| 0.05049 | 0.999 |
| 0.0505 | 0.999 |
| 0.05051 | 0.999 |
| 0.05052 | 0.999 |
| 0.05053 | 0.999 |
| 0.05054 | 0.999 |
| 0.05055 | 0.999 |
| 0.05056 | 0.999 |
| 0.05057 | 0.999 |
| 0.05058 | 0.999 |
| 0.05059 | 0.999 |
| 0.0506 | 0.999 |
| 0.05061 | 0.999 |
| 0.05062 | 0.999 |
| 0.05063 | 0.999 |
| 0.05064 | 0.999 |
| 0.05065 | 0.999 |
| 0.05066 | 0.999 |
| 0.05067 | 0.999 |
| 0.05068 | 0.999 |
| 0.05069 | 0.999 |
| 0.0507 | 0.999 |
| 0.05071 | 0.999 |
| 0.05072 | 0.999 |
| 0.05073 | 0.999 |
| 0.05074 | 0.999 |
| 0.05075 | 0.999 |
| 0.05076 | 0.999 |
| 0.05077 | 0.999 |
| 0.05078 | 0.999 |
| 0.05079 | 0.999 |
| 0.0508 | 0.999 |
| 0.05081 | 0.999 |
| 0.05082 | 0.999 |
| 0.05083 | 0.999 |
| 0.05084 | 0.999 |
| 0.05085 | 0.999 |
| 0.05086 | 0.999 |
| 0.05087 | 0.999 |
| 0.05088 | 0.999 |
| 0.05089 | 0.999 |
| 0.0509 | 0.999 |
| 0.05091 | 0.999 |
| 0.05092 | 0.999 |
| 0.05093 | 0.999 |
| 0.05094 | 0.999 |
| 0.05095 | 0.999 |
| 0.05096 | 0.999 |
| 0.05097 | 0.999 |
| 0.05098 | 0.999 |
| 0.05099 | 0.999 |
| 0.051 | 0.999 |
| 0.05101 | 0.999 |
| 0.05102 | 0.999 |
| 0.05103 | 0.999 |
| 0.05104 | 0.999 |
| 0.05105 | 0.999 |
| 0.05106 | 0.999 |
| 0.05107 | 0.999 |
| 0.05108 | 0.999 |
| 0.05109 | 0.999 |
| 0.0511 | 0.999 |
| 0.05111 | 0.999 |
| 0.05112 | 0.999 |
| 0.05113 | 0.999 |
| 0.05114 | 0.999 |
| 0.05115 | 0.999 |
| 0.05116 | 0.999 |
| 0.05117 | 0.999 |
| 0.05118 | 0.999 |
| 0.05119 | 0.999 |
| 0.0512 | 0.999 |
| 0.05121 | 0.999 |
| 0.05122 | 0.999 |
| 0.05123 | 0.999 |
| 0.05124 | 0.999 |
| 0.05125 | 0.999 |
| 0.05126 | 0.999 |
| 0.05127 | 0.999 |
| 0.05128 | 0.999 |
| 0.05129 | 0.999 |
| 0.0513 | 0.999 |
| 0.05131 | 0.999 |
| 0.05132 | 0.999 |
| 0.05133 | 0.999 |
| 0.05134 | 0.999 |
| 0.05135 | 0.999 |
| 0.05136 | 0.999 |
| 0.05137 | 0.999 |
| 0.05138 | 0.999 |
| 0.05139 | 0.999 |
| 0.0514 | 0.999 |
| 0.05141 | 0.999 |
| 0.05142 | 0.999 |
| 0.05143 | 0.999 |
| 0.05144 | 0.999 |
| 0.05145 | 0.999 |
| 0.05146 | 0.999 |
| 0.05147 | 0.999 |
| 0.05148 | 0.999 |
| 0.05149 | 0.999 |
| 0.0515 | 0.999 |
| 0.05151 | 0.999 |
| 0.05152 | 0.999 |
| 0.05153 | 0.999 |
| 0.05154 | 0.999 |
| 0.05155 | 0.999 |
| 0.05156 | 0.999 |
| 0.05157 | 0.999 |
| 0.05158 | 0.999 |
| 0.05159 | 0.999 |
| 0.0516 | 0.999 |
| 0.05161 | 0.999 |
| 0.05162 | 0.999 |
| 0.05163 | 0.999 |
| 0.05164 | 0.999 |
| 0.05165 | 0.999 |
| 0.05166 | 0.999 |
| 0.05167 | 0.999 |
| 0.05168 | 0.999 |
| 0.05169 | 0.999 |
| 0.0517 | 0.999 |
| 0.05171 | 0.999 |
| 0.05172 | 0.999 |
| 0.05173 | 0.999 |
| 0.05174 | 0.999 |
| 0.05175 | 0.999 |
| 0.05176 | 0.999 |
| 0.05177 | 0.999 |
| 0.05178 | 0.999 |
| 0.05179 | 0.999 |
| 0.0518 | 0.999 |
| 0.05181 | 0.999 |
| 0.05182 | 0.999 |
| 0.05183 | 0.999 |
| 0.05184 | 0.999 |
| 0.05185 | 0.999 |
| 0.05186 | 0.999 |
| 0.05187 | 0.999 |
| 0.05188 | 0.999 |
| 0.05189 | 0.999 |
| 0.0519 | 0.999 |
| 0.05191 | 0.999 |
| 0.05192 | 0.999 |
| 0.05193 | 0.999 |
| 0.05194 | 0.999 |
| 0.05195 | 0.999 |
| 0.05196 | 0.999 |
| 0.05197 | 0.999 |
| 0.05198 | 0.999 |
| 0.05199 | 0.999 |
| 0.052 | 0.999 |
| 0.05201 | 0.999 |
| 0.05202 | 0.999 |
| 0.05203 | 0.999 |
| 0.05204 | 0.999 |
| 0.05205 | 0.999 |
| 0.05206 | 0.999 |
| 0.05207 | 0.999 |
| 0.05208 | 0.999 |
| 0.05209 | 0.999 |
| 0.0521 | 0.999 |
| 0.05211 | 0.999 |
| 0.05212 | 0.999 |
| 0.05213 | 0.999 |
| 0.05214 | 0.999 |
| 0.05215 | 0.999 |
| 0.05216 | 0.999 |
| 0.05217 | 0.999 |
| 0.05218 | 0.999 |
| 0.05219 | 0.999 |
| 0.0522 | 0.999 |
| 0.05221 | 0.999 |
| 0.05222 | 0.999 |
| 0.05223 | 0.999 |
| 0.05224 | 0.999 |
| 0.05225 | 0.999 |
| 0.05226 | 0.999 |
| 0.05227 | 0.999 |
| 0.05228 | 0.999 |
| 0.05229 | 0.999 |
| 0.0523 | 0.999 |
| 0.05231 | 0.999 |
| 0.05232 | 0.999 |
| 0.05233 | 0.999 |
| 0.05234 | 0.999 |
| 0.05235 | 0.999 |
| 0.05236 | 0.999 |
| 0.05237 | 0.999 |
| 0.05238 | 0.999 |
| 0.05239 | 0.999 |
| 0.0524 | 0.999 |
| 0.05241 | 0.999 |
| 0.05242 | 0.999 |
| 0.05243 | 0.999 |
| 0.05244 | 0.999 |
| 0.05245 | 0.999 |
| 0.05246 | 0.999 |
| 0.05247 | 0.999 |
| 0.05248 | 0.999 |
| 0.05249 | 0.999 |
| 0.0525 | 0.999 |
| 0.05251 | 0.999 |
| 0.05252 | 0.999 |
| 0.05253 | 0.999 |
| 0.05254 | 0.999 |
| 0.05255 | 0.999 |
| 0.05256 | 0.999 |
| 0.05257 | 0.999 |
| 0.05258 | 0.999 |
| 0.05259 | 0.999 |
| 0.0526 | 0.999 |
| 0.05261 | 0.999 |
| 0.05262 | 0.999 |
| 0.05263 | 0.999 |
| 0.05264 | 0.999 |
| 0.05265 | 0.999 |
| 0.05266 | 0.999 |
| 0.05267 | 0.999 |
| 0.05268 | 0.999 |
| 0.05269 | 0.999 |
| 0.0527 | 0.999 |
| 0.05271 | 0.999 |
| 0.05272 | 0.999 |
| 0.05273 | 0.999 |
| 0.05274 | 0.999 |
| 0.05275 | 0.999 |
| 0.05276 | 0.999 |
| 0.05277 | 0.999 |
| 0.05278 | 0.999 |
| 0.05279 | 0.999 |
| 0.0528 | 0.999 |
| 0.05281 | 0.999 |
| 0.05282 | 0.999 |
| 0.05283 | 0.999 |
| 0.05284 | 0.999 |
| 0.05285 | 0.999 |
| 0.05286 | 0.999 |
| 0.05287 | 0.999 |
| 0.05288 | 0.999 |
| 0.05289 | 0.999 |
| 0.0529 | 0.999 |
| 0.05291 | 0.999 |
| 0.05292 | 0.999 |
| 0.05293 | 0.999 |
| 0.05294 | 0.999 |
| 0.05295 | 0.999 |
| 0.05296 | 0.999 |
| 0.05297 | 0.999 |
| 0.05298 | 0.999 |
| 0.05299 | 0.999 |
| 0.053 | 0.999 |
| 0.05301 | 0.999 |
| 0.05302 | 0.999 |
| 0.05303 | 0.999 |
| 0.05304 | 0.999 |
| 0.05305 | 0.999 |
| 0.05306 | 0.999 |
| 0.05307 | 0.999 |
| 0.05308 | 0.999 |
| 0.05309 | 0.999 |
| 0.0531 | 0.999 |
| 0.05311 | 0.999 |
| 0.05312 | 0.999 |
| 0.05313 | 0.999 |
| 0.05314 | 0.999 |
| 0.05315 | 0.999 |
| 0.05316 | 0.999 |
| 0.05317 | 0.999 |
| 0.05318 | 0.999 |
| 0.05319 | 0.999 |
| 0.0532 | 0.999 |
| 0.05321 | 0.999 |
| 0.05322 | 0.999 |
| 0.05323 | 0.999 |
| 0.05324 | 0.999 |
| 0.05325 | 0.999 |
| 0.05326 | 0.999 |
| 0.05327 | 0.999 |
| 0.05328 | 0.999 |
| 0.05329 | 0.999 |
| 0.0533 | 0.999 |
| 0.05331 | 0.999 |
| 0.05332 | 0.999 |
| 0.05333 | 0.999 |
| 0.05334 | 0.999 |
| 0.05335 | 0.999 |
| 0.05336 | 0.999 |
| 0.05337 | 0.999 |
| 0.05338 | 0.999 |
| 0.05339 | 0.999 |
| 0.0534 | 0.999 |
| 0.05341 | 0.999 |
| 0.05342 | 0.999 |
| 0.05343 | 0.999 |
| 0.05344 | 0.999 |
| 0.05345 | 0.999 |
| 0.05346 | 0.999 |
| 0.05347 | 0.999 |
| 0.05348 | 0.999 |
| 0.05349 | 0.999 |
| 0.0535 | 0.999 |
| 0.05351 | 0.999 |
| 0.05352 | 0.999 |
| 0.05353 | 0.999 |
| 0.05354 | 0.999 |
| 0.05355 | 0.999 |
| 0.05356 | 0.999 |
| 0.05357 | 0.999 |
| 0.05358 | 0.999 |
| 0.05359 | 0.999 |
| 0.0536 | 0.999 |
| 0.05361 | 0.999 |
| 0.05362 | 0.999 |
| 0.05363 | 0.999 |
| 0.05364 | 0.999 |
| 0.05365 | 0.999 |
| 0.05366 | 0.999 |
| 0.05367 | 0.999 |
| 0.05368 | 0.999 |
| 0.05369 | 0.999 |
| 0.0537 | 0.999 |
| 0.05371 | 0.999 |
| 0.05372 | 0.999 |
| 0.05373 | 0.999 |
| 0.05374 | 0.999 |
| 0.05375 | 0.999 |
| 0.05376 | 0.999 |
| 0.05377 | 0.999 |
| 0.05378 | 0.999 |
| 0.05379 | 0.999 |
| 0.0538 | 0.999 |
| 0.05381 | 0.999 |
| 0.05382 | 0.999 |
| 0.05383 | 0.999 |
| 0.05384 | 0.999 |
| 0.05385 | 0.999 |
| 0.05386 | 0.999 |
| 0.05387 | 0.999 |
| 0.05388 | 0.999 |
| 0.05389 | 0.999 |
| 0.0539 | 0.999 |
| 0.05391 | 0.999 |
| 0.05392 | 0.999 |
| 0.05393 | 0.999 |
| 0.05394 | 0.999 |
| 0.05395 | 0.999 |
| 0.05396 | 0.999 |
| 0.05397 | 0.999 |
| 0.05398 | 0.999 |
| 0.05399 | 0.999 |
| 0.054 | 0.999 |
| 0.05401 | 0.999 |
| 0.05402 | 0.999 |
| 0.05403 | 0.999 |
| 0.05404 | 0.999 |
| 0.05405 | 0.999 |
| 0.05406 | 1 |
| 0.05407 | 1 |
| 0.05408 | 1 |
| 0.05409 | 1 |
| 0.0541 | 1 |
| 0.05411 | 1 |
| 0.05412 | 1 |
| 0.05413 | 1 |
| 0.05414 | 1 |
| 0.05415 | 1 |
| 0.05416 | 1 |
| 0.05417 | 1 |
| 0.05418 | 1 |
| 0.05419 | 1 |
| 0.0542 | 1 |
| 0.05421 | 1 |
| 0.05422 | 1 |
| 0.05423 | 1 |
| 0.05424 | 1 |
| 0.05425 | 1 |
| 0.05426 | 1 |
| 0.05427 | 1 |
| 0.05428 | 1 |
| 0.05429 | 1 |
| 0.0543 | 1 |
| 0.05431 | 1 |
| 0.05432 | 1 |
| 0.05433 | 1 |
| 0.05434 | 1 |
| 0.05435 | 1 |
| 0.05436 | 1 |
| 0.05437 | 1 |
| 0.05438 | 1 |
| 0.05439 | 1 |
| 0.0544 | 1 |
| 0.05441 | 1 |
| 0.05442 | 1 |
| 0.05443 | 1 |
| 0.05444 | 1 |
| 0.05445 | 1 |
| 0.05446 | 1 |
| 0.05447 | 1 |
| 0.05448 | 1 |
| 0.05449 | 1 |
| 0.0545 | 1 |
| 0.05451 | 1 |
| 0.05452 | 1 |
| 0.05453 | 1 |
| 0.05454 | 1 |
| 0.05455 | 1 |
| 0.05456 | 1 |
| 0.05457 | 1 |
| 0.05458 | 1 |
| 0.05459 | 1 |
| 0.0546 | 1 |
| 0.05461 | 1 |
| 0.05462 | 1 |
| 0.05463 | 1 |
| 0.05464 | 1 |
| 0.05465 | 1 |
| 0.05466 | 1 |
| 0.05467 | 1 |
| 0.05468 | 1 |
| 0.05469 | 1 |
| 0.0547 | 1 |
| 0.05471 | 1 |
| 0.05472 | 1 |
| 0.05473 | 1 |
| 0.05474 | 1 |
| 0.05475 | 1 |
| 0.05476 | 1 |
| 0.05477 | 1 |
| 0.05478 | 1 |
| 0.05479 | 1 |
| 0.0548 | 1 |
| 0.05481 | 1 |
| 0.05482 | 1 |
| 0.05483 | 1 |
| 0.05484 | 1 |
| 0.05485 | 1 |
| 0.05486 | 1 |
| 0.05487 | 1 |
| 0.05488 | 1 |
| 0.05489 | 1 |
| 0.0549 | 1 |
| 0.05491 | 1 |
| 0.05492 | 1 |
| 0.05493 | 1 |
| 0.05494 | 1 |
| 0.05495 | 1 |
| 0.05496 | 1 |
| 0.05497 | 1 |
| 0.05498 | 1 |
| 0.05499 | 1 |
| 0.055 | 1 |
| 0.05501 | 1 |
| 0.05502 | 1 |
| 0.05503 | 1 |
| 0.05504 | 1 |
| 0.05505 | 1 |
| 0.05506 | 1 |
| 0.05507 | 1 |
| 0.05508 | 1 |
| 0.05509 | 1 |
| 0.0551 | 1 |
| 0.05511 | 1 |
| 0.05512 | 1 |
| 0.05513 | 1 |
| 0.05514 | 1 |
| 0.05515 | 1 |
| 0.05516 | 1 |
| 0.05517 | 1 |
| 0.05518 | 1 |
| 0.05519 | 1 |
| 0.0552 | 1 |
| 0.05521 | 1 |
| 0.05522 | 1 |
| 0.05523 | 1 |
| 0.05524 | 1 |
| 0.05525 | 1 |
| 0.05526 | 1 |
| 0.05527 | 1 |
| 0.05528 | 1 |
| 0.05529 | 1 |
| 0.0553 | 1 |
| 0.05531 | 1 |
| 0.05532 | 1 |
| 0.05533 | 1 |
| 0.05534 | 1 |
| 0.05535 | 1 |
| 0.05536 | 1 |
| 0.05537 | 1 |
| 0.05538 | 1 |
| 0.05539 | 1 |
| 0.0554 | 1 |
| 0.05541 | 1 |
| 0.05542 | 1 |
| 0.05543 | 1 |
| 0.05544 | 1 |
| 0.05545 | 1 |
| 0.05546 | 1 |
| 0.05547 | 1 |
| 0.05548 | 1 |
| 0.05549 | 1 |
| 0.0555 | 1 |
| 0.05551 | 1 |
| 0.05552 | 1 |
| 0.05553 | 1 |
| 0.05554 | 1 |
| 0.05555 | 1 |
| 0.05556 | 1 |
| 0.05557 | 1 |
| 0.05558 | 1 |
| 0.05559 | 1 |
| 0.0556 | 1 |
| 0.05561 | 1 |
| 0.05562 | 1 |
| 0.05563 | 1 |
| 0.05564 | 1 |
| 0.05565 | 1 |
| 0.05566 | 1 |
| 0.05567 | 1 |
| 0.05568 | 1 |
| 0.05569 | 1 |
| 0.0557 | 1 |
| 0.05571 | 1 |
| 0.05572 | 1 |
| 0.05573 | 1 |
| 0.05574 | 1 |
| 0.05575 | 1 |
| 0.05576 | 1 |
| 0.05577 | 1 |
| 0.05578 | 1 |
| 0.05579 | 1 |
| 0.0558 | 1 |
| 0.05581 | 1 |
| 0.05582 | 1 |
| 0.05583 | 1 |
| 0.05584 | 1 |
| 0.05585 | 1 |
| 0.05586 | 1 |
| 0.05587 | 1 |
| 0.05588 | 1 |
| 0.05589 | 1 |
| 0.0559 | 1 |
| 0.05591 | 1 |
| 0.05592 | 1 |
| 0.05593 | 1 |
| 0.05594 | 1 |
| 0.05595 | 1 |
| 0.05596 | 1 |
| 0.05597 | 1 |
| 0.05598 | 1 |
| 0.05599 | 1 |
| 0.056 | 1 |
| 0.05601 | 1 |
| 0.05602 | 1 |
| 0.05603 | 1 |
| 0.05604 | 1 |
| 0.05605 | 1 |
| 0.05606 | 1 |
| 0.05607 | 1 |
| 0.05608 | 1 |
| 0.05609 | 1 |
| 0.0561 | 1 |
| 0.05611 | 1 |
| 0.05612 | 1 |
| 0.05613 | 1 |
| 0.05614 | 1 |
| 0.05615 | 1 |
| 0.05616 | 1 |
| 0.05617 | 1 |
| 0.05618 | 1 |
| 0.05619 | 1 |
| 0.0562 | 1 |
| 0.05621 | 1 |
| 0.05622 | 1 |
| 0.05623 | 1 |
| 0.05624 | 1 |
| 0.05625 | 1 |
| 0.05626 | 1 |
| 0.05627 | 1 |
| 0.05628 | 1 |
| 0.05629 | 1 |
| 0.0563 | 1 |
| 0.05631 | 1 |
| 0.05632 | 1 |
| 0.05633 | 1 |
| 0.05634 | 1 |
| 0.05635 | 1 |
| 0.05636 | 1 |
| 0.05637 | 1 |
| 0.05638 | 1 |
| 0.05639 | 1 |
| 0.0564 | 1 |
| 0.05641 | 1 |
| 0.05642 | 1 |
| 0.05643 | 1 |
| 0.05644 | 1 |
| 0.05645 | 1 |
| 0.05646 | 1 |
| 0.05647 | 1 |
| 0.05648 | 1 |
| 0.05649 | 1 |
| 0.0565 | 1 |
| 0.05651 | 1 |
| 0.05652 | 1 |
| 0.05653 | 1 |
| 0.05654 | 1 |
| 0.05655 | 1 |
| 0.05656 | 1 |
| 0.05657 | 1 |
| 0.05658 | 1 |
| 0.05659 | 1 |
| 0.0566 | 1 |
| 0.05661 | 1 |
| 0.05662 | 1 |
| 0.05663 | 1 |
| 0.05664 | 1 |
| 0.05665 | 1 |
| 0.05666 | 1 |
| 0.05667 | 1 |
| 0.05668 | 1 |
| 0.05669 | 1 |
| 0.0567 | 1 |
| 0.05671 | 1 |
| 0.05672 | 1 |
| 0.05673 | 1 |
| 0.05674 | 1 |
| 0.05675 | 1 |
| 0.05676 | 1 |
| 0.05677 | 1 |
| 0.05678 | 1 |
| 0.05679 | 1 |
| 0.0568 | 1 |
| 0.05681 | 1 |
| 0.05682 | 1 |
| 0.05683 | 1 |
| 0.05684 | 1 |
| 0.05685 | 1 |
| 0.05686 | 1 |
| 0.05687 | 1 |
| 0.05688 | 1 |
| 0.05689 | 1 |
| 0.0569 | 1 |
| 0.05691 | 1 |
| 0.05692 | 1 |
| 0.05693 | 1 |
| 0.05694 | 1 |
| 0.05695 | 1 |
| 0.05696 | 1 |
| 0.05697 | 1 |
| 0.05698 | 1 |
| 0.05699 | 1 |
| 0.057 | 1 |
| 0.05701 | 1 |
| 0.05702 | 1 |
| 0.05703 | 1 |
| 0.05704 | 1 |
| 0.05705 | 1 |
| 0.05706 | 1 |
| 0.05707 | 1 |
| 0.05708 | 1 |
| 0.05709 | 1 |
| 0.0571 | 1 |
| 0.05711 | 1 |
| 0.05712 | 1 |
| 0.05713 | 1 |
| 0.05714 | 1 |
| 0.05715 | 1 |
| 0.05716 | 1 |
| 0.05717 | 1 |
| 0.05718 | 1 |
| 0.05719 | 1 |
| 0.0572 | 1 |
| 0.05721 | 1 |
| 0.05722 | 1 |
| 0.05723 | 1 |
| 0.05724 | 1 |
| 0.05725 | 1 |
| 0.05726 | 1 |
| 0.05727 | 1 |
| 0.05728 | 1 |
| 0.05729 | 1 |
| 0.0573 | 1 |
| 0.05731 | 1 |
| 0.05732 | 1 |
| 0.05733 | 1 |
| 0.05734 | 1 |
| 0.05735 | 1 |
| 0.05736 | 1 |
| 0.05737 | 1 |
| 0.05738 | 1 |
| 0.05739 | 1 |
| 0.0574 | 1 |
| 0.05741 | 1 |
| 0.05742 | 1 |
| 0.05743 | 1 |
| 0.05744 | 1 |
| 0.05745 | 1 |
| 0.05746 | 1 |
| 0.05747 | 1 |
| 0.05748 | 1 |
| 0.05749 | 1 |
| 0.0575 | 1 |
| 0.05751 | 1 |
| 0.05752 | 1 |
| 0.05753 | 1 |
| 0.05754 | 1 |
| 0.05755 | 1 |
| 0.05756 | 1 |
| 0.05757 | 1 |
| 0.05758 | 1 |
| 0.05759 | 1 |
| 0.0576 | 1 |
| 0.05761 | 1 |
| 0.05762 | 1 |
| 0.05763 | 1 |
| 0.05764 | 1 |
| 0.05765 | 1 |
| 0.05766 | 1 |
| 0.05767 | 1 |
| 0.05768 | 1 |
| 0.05769 | 1 |
| 0.0577 | 1 |
| 0.05771 | 1 |
| 0.05772 | 1 |
| 0.05773 | 1 |
| 0.05774 | 1 |
| 0.05775 | 1 |
| 0.05776 | 1 |
| 0.05777 | 1 |
| 0.05778 | 1 |
| 0.05779 | 1 |
| 0.0578 | 1 |
| 0.05781 | 1 |
| 0.05782 | 1 |
| 0.05783 | 1 |
| 0.05784 | 1 |
| 0.05785 | 1 |
| 0.05786 | 1 |
| 0.05787 | 1 |
| 0.05788 | 1 |
| 0.05789 | 1 |
| 0.0579 | 1 |
| 0.05791 | 1 |
| 0.05792 | 1 |
| 0.05793 | 1 |
| 0.05794 | 1 |
| 0.05795 | 1 |
| 0.05796 | 1 |
| 0.05797 | 1 |
| 0.05798 | 1 |
| 0.05799 | 1 |
| 0.058 | 1 |
| 0.05801 | 1 |
| 0.05802 | 1 |
| 0.05803 | 1 |
| 0.05804 | 1 |
| 0.05805 | 1 |
| 0.05806 | 1 |
| 0.05807 | 1 |
| 0.05808 | 1 |
| 0.05809 | 1 |
| 0.0581 | 1 |
| 0.05811 | 1 |
| 0.05812 | 1 |
| 0.05813 | 1 |
| 0.05814 | 1 |
| 0.05815 | 1 |
| 0.05816 | 1 |
| 0.05817 | 1 |
| 0.05818 | 1 |
| 0.05819 | 1 |
| 0.0582 | 1 |
| 0.05821 | 1 |
| 0.05822 | 1 |
| 0.05823 | 1 |
| 0.05824 | 1 |
| 0.05825 | 1 |
| 0.05826 | 1 |
| 0.05827 | 1 |
| 0.05828 | 1 |
| 0.05829 | 1 |
| 0.0583 | 1 |
| 0.05831 | 1 |
| 0.05832 | 1 |
| 0.05833 | 1 |
| 0.05834 | 1 |
| 0.05835 | 1 |
| 0.05836 | 1 |
| 0.05837 | 1 |
| 0.05838 | 1 |
| 0.05839 | 1 |
| 0.0584 | 1 |
| 0.05841 | 1 |
| 0.05842 | 1 |
| 0.05843 | 1 |
| 0.05844 | 1 |
| 0.05845 | 1 |
| 0.05846 | 1 |
| 0.05847 | 1 |
| 0.05848 | 1 |
| 0.05849 | 1 |
| 0.0585 | 1 |
| 0.05851 | 1 |
| 0.05852 | 1 |
| 0.05853 | 1 |
| 0.05854 | 1 |
| 0.05855 | 1 |
| 0.05856 | 1 |
| 0.05857 | 1 |
| 0.05858 | 1 |
| 0.05859 | 1 |
| 0.0586 | 1 |
| 0.05861 | 1 |
| 0.05862 | 1 |
| 0.05863 | 1 |
| 0.05864 | 1 |
| 0.05865 | 1 |
| 0.05866 | 1 |
| 0.05867 | 1 |
| 0.05868 | 1 |
| 0.05869 | 1 |
| 0.0587 | 1 |
| 0.05871 | 1 |
| 0.05872 | 1 |
| 0.05873 | 1 |
| 0.05874 | 1 |
| 0.05875 | 1 |
| 0.05876 | 1 |
| 0.05877 | 1 |
| 0.05878 | 1 |
| 0.05879 | 1 |
| 0.0588 | 1 |
| 0.05881 | 1 |
| 0.05882 | 1 |
| 0.05883 | 1 |
| 0.05884 | 1 |
| 0.05885 | 1 |
| 0.05886 | 1 |
| 0.05887 | 1 |
| 0.05888 | 1 |
| 0.05889 | 1 |
| 0.0589 | 1 |
| 0.05891 | 1 |
| 0.05892 | 1 |
| 0.05893 | 1 |
| 0.05894 | 1 |
| 0.05895 | 1 |
| 0.05896 | 1 |
| 0.05897 | 1 |
| 0.05898 | 1 |
| 0.05899 | 1 |
| 0.059 | 1 |
| 0.05901 | 1 |
| 0.05902 | 1 |
| 0.05903 | 1 |
| 0.05904 | 1 |
| 0.05905 | 1 |
| 0.05906 | 1 |
| 0.05907 | 1 |
| 0.05908 | 1 |
| 0.05909 | 1 |
| 0.0591 | 1 |
| 0.05911 | 1 |
| 0.05912 | 1 |
| 0.05913 | 1 |
| 0.05914 | 1 |
| 0.05915 | 1 |
| 0.05916 | 1 |
| 0.05917 | 1 |
| 0.05918 | 1 |
| 0.05919 | 1 |
| 0.0592 | 1 |
| 0.05921 | 1 |
| 0.05922 | 1 |
| 0.05923 | 1 |
| 0.05924 | 1 |
| 0.05925 | 1 |
| 0.05926 | 1 |
| 0.05927 | 1 |
| 0.05928 | 1 |
| 0.05929 | 1 |
| 0.0593 | 1 |
| 0.05931 | 1 |
| 0.05932 | 1 |
| 0.05933 | 1 |
| 0.05934 | 1 |
| 0.05935 | 1 |
| 0.05936 | 1 |
| 0.05937 | 1 |
| 0.05938 | 1 |
| 0.05939 | 1 |
| 0.0594 | 1 |
| 0.05941 | 1 |
| 0.05942 | 1 |
| 0.05943 | 1 |
| 0.05944 | 1 |
| 0.05945 | 1 |
| 0.05946 | 1 |
| 0.05947 | 1 |
| 0.05948 | 1 |
| 0.05949 | 1 |
| 0.0595 | 1 |
| 0.05951 | 1 |
| 0.05952 | 1 |
| 0.05953 | 1 |
| 0.05954 | 1 |
| 0.05955 | 1 |
| 0.05956 | 1 |
| 0.05957 | 1 |
| 0.05958 | 1 |
| 0.05959 | 1 |
| 0.0596 | 1 |
| 0.05961 | 1 |
| 0.05962 | 1 |
| 0.05963 | 1 |
| 0.05964 | 1 |
| 0.05965 | 1 |
| 0.05966 | 1 |
| 0.05967 | 1 |
| 0.05968 | 1 |
| 0.05969 | 1 |
| 0.0597 | 1 |
| 0.05971 | 1 |
| 0.05972 | 1 |
| 0.05973 | 1 |
| 0.05974 | 1 |
| 0.05975 | 1 |
| 0.05976 | 1 |
| 0.05977 | 1 |
| 0.05978 | 1 |
| 0.05979 | 1 |
| 0.0598 | 1 |
| 0.05981 | 1 |
| 0.05982 | 1 |
| 0.05983 | 1 |
| 0.05984 | 1 |
| 0.05985 | 1 |
| 0.05986 | 1 |
| 0.05987 | 1 |
| 0.05988 | 1 |
| 0.05989 | 1 |
| 0.0599 | 1 |
| 0.05991 | 1 |
| 0.05992 | 1 |
| 0.05993 | 1 |
| 0.05994 | 1 |
| 0.05995 | 1 |
| 0.05996 | 1 |
| 0.05997 | 1 |
| 0.05998 | 1 |
| 0.05999 | 1 |
| 0.06 | 1 |
| 0.06001 | 1 |
| 0.06002 | 1 |
| 0.06003 | 1 |
| 0.06004 | 1 |
| 0.06005 | 1 |
| 0.06006 | 1 |
| 0.06007 | 1 |
| 0.06008 | 1 |
| 0.06009 | 1 |
| 0.0601 | 1 |
| 0.06011 | 1 |
| 0.06012 | 1 |
| 0.06013 | 1 |
| 0.06014 | 1 |
| 0.06015 | 1 |
| 0.06016 | 1 |
| 0.06017 | 1 |
| 0.06018 | 1 |
| 0.06019 | 1 |
| 0.0602 | 1 |
| 0.06021 | 1 |
| 0.06022 | 1 |
| 0.06023 | 1 |
| 0.06024 | 1 |
| 0.06025 | 1 |
| 0.06026 | 1 |
| 0.06027 | 1 |
| 0.06028 | 1 |
| 0.06029 | 1 |
| 0.0603 | 1 |
| 0.06031 | 1 |
| 0.06032 | 1 |
| 0.06033 | 1 |
| 0.06034 | 1 |
| 0.06035 | 1 |
| 0.06036 | 1 |
| 0.06037 | 1 |
| 0.06038 | 1 |
| 0.06039 | 1 |
| 0.0604 | 1 |
| 0.06041 | 1 |
| 0.06042 | 1 |
| 0.06043 | 1 |
| 0.06044 | 1 |
| 0.06045 | 1 |
| 0.06046 | 1 |
| 0.06047 | 1 |
| 0.06048 | 1 |
| 0.06049 | 1 |
| 0.0605 | 1 |
| 0.06051 | 1 |
| 0.06052 | 1 |
| 0.06053 | 1 |
| 0.06054 | 1 |
| 0.06055 | 1 |
| 0.06056 | 1 |
| 0.06057 | 1 |
| 0.06058 | 1 |
| 0.06059 | 1 |
| 0.0606 | 1 |
| 0.06061 | 1 |
| 0.06062 | 1 |
| 0.06063 | 1 |
| 0.06064 | 1 |
| 0.06065 | 1 |
| 0.06066 | 1 |
| 0.06067 | 1 |
| 0.06068 | 1 |
| 0.06069 | 1 |
| 0.0607 | 1 |
| 0.06071 | 1 |
| 0.06072 | 1 |
| 0.06073 | 1 |
| 0.06074 | 1 |
| 0.06075 | 1 |
| 0.06076 | 1 |
| 0.06077 | 1 |
| 0.06078 | 1 |
| 0.06079 | 1 |
| 0.0608 | 1 |
| 0.06081 | 1 |
| 0.06082 | 1 |
| 0.06083 | 1 |
| 0.06084 | 1 |
| 0.06085 | 1 |
| 0.06086 | 1 |
| 0.06087 | 1 |
| 0.06088 | 1 |
| 0.06089 | 1 |
| 0.0609 | 1 |
| 0.06091 | 1 |
| 0.06092 | 1 |
| 0.06093 | 1 |
| 0.06094 | 1 |
| 0.06095 | 1 |
| 0.06096 | 1 |
| 0.06097 | 1 |
| 0.06098 | 1 |
| 0.06099 | 1 |
| 0.061 | 1 |
| 0.06101 | 1 |
| 0.06102 | 1 |
| 0.06103 | 1 |
| 0.06104 | 1 |
| 0.06105 | 1 |
| 0.06106 | 1 |
| 0.06107 | 1 |
| 0.06108 | 1 |
| 0.06109 | 1 |
| 0.0611 | 1 |
| 0.06111 | 1 |
| 0.06112 | 1 |
| 0.06113 | 1 |
| 0.06114 | 1 |
| 0.06115 | 1 |
| 0.06116 | 1 |
| 0.06117 | 1 |
| 0.06118 | 1 |
| 0.06119 | 1 |
| 0.0612 | 1 |
| 0.06121 | 1 |
| 0.06122 | 1 |
| 0.06123 | 1 |
| 0.06124 | 1 |
| 0.06125 | 1 |
| 0.06126 | 1 |
| 0.06127 | 1 |
| 0.06128 | 1 |
| 0.06129 | 1 |
| 0.0613 | 1 |
| 0.06131 | 1 |
| 0.06132 | 1 |
| 0.06133 | 1 |
| 0.06134 | 1 |
| 0.06135 | 1 |
| 0.06136 | 1 |
| 0.06137 | 1 |
| 0.06138 | 1 |
| 0.06139 | 1 |
| 0.0614 | 1 |
| 0.06141 | 1 |
| 0.06142 | 1 |
| 0.06143 | 1 |
| 0.06144 | 1 |
| 0.06145 | 1 |
| 0.06146 | 1 |
| 0.06147 | 1 |
| 0.06148 | 1 |
| 0.06149 | 1 |
| 0.0615 | 1 |
| 0.06151 | 1 |
| 0.06152 | 1 |
| 0.06153 | 1 |
| 0.06154 | 1 |
| 0.06155 | 1 |
| 0.06156 | 1 |
| 0.06157 | 1 |
| 0.06158 | 1 |
| 0.06159 | 1 |
| 0.0616 | 1 |
| 0.06161 | 1 |
| 0.06162 | 1 |
| 0.06163 | 1 |
| 0.06164 | 1 |
| 0.06165 | 1 |
| 0.06166 | 1 |
| 0.06167 | 1 |
| 0.06168 | 1 |
| 0.06169 | 1 |
| 0.0617 | 1 |
| 0.06171 | 1 |
| 0.06172 | 1 |
| 0.06173 | 1 |
| 0.06174 | 1 |
| 0.06175 | 1 |
| 0.06176 | 1 |
| 0.06177 | 1 |
| 0.06178 | 1 |
| 0.06179 | 1 |
| 0.0618 | 1 |
| 0.06181 | 1 |
| 0.06182 | 1 |
| 0.06183 | 1 |
| 0.06184 | 1 |
| 0.06185 | 1 |
| 0.06186 | 1 |
| 0.06187 | 1 |
| 0.06188 | 1 |
| 0.06189 | 1 |
| 0.0619 | 1 |
| 0.06191 | 1 |
| 0.06192 | 1 |
| 0.06193 | 1 |
| 0.06194 | 1 |
| 0.06195 | 1 |
| 0.06196 | 1 |
| 0.06197 | 1 |
| 0.06198 | 1 |
| 0.06199 | 1 |
| 0.062 | 1 |
| 0.06201 | 1 |
| 0.06202 | 1 |
| 0.06203 | 1 |
| 0.06204 | 1 |
| 0.06205 | 1 |
| 0.06206 | 1 |
| 0.06207 | 1 |
| 0.06208 | 1 |
| 0.06209 | 1 |
| 0.0621 | 1 |
| 0.06211 | 1 |
| 0.06212 | 1 |
| 0.06213 | 1 |
| 0.06214 | 1 |
| 0.06215 | 1 |
| 0.06216 | 1 |
| 0.06217 | 1 |
| 0.06218 | 1 |
| 0.06219 | 1 |
| 0.0622 | 1 |
| 0.06221 | 1 |
| 0.06222 | 1 |
| 0.06223 | 1 |
| 0.06224 | 1 |
| 0.06225 | 1 |
| 0.06226 | 1 |
| 0.06227 | 1 |
| 0.06228 | 1 |
| 0.06229 | 1 |
| 0.0623 | 1 |
| 0.06231 | 1 |
| 0.06232 | 1 |
| 0.06233 | 1 |
| 0.06234 | 1 |
| 0.06235 | 1 |
| 0.06236 | 1 |
| 0.06237 | 1 |
| 0.06238 | 1 |
| 0.06239 | 1 |
| 0.0624 | 1 |
| 0.06241 | 1 |
| 0.06242 | 1 |
| 0.06243 | 1 |
| 0.06244 | 1 |
| 0.06245 | 1 |
| 0.06246 | 1 |
| 0.06247 | 1 |
| 0.06248 | 1 |
| 0.06249 | 1 |
| 0.0625 | 1 |
| 0.06251 | 1 |
| 0.06252 | 1 |
| 0.06253 | 1 |
| 0.06254 | 1 |
| 0.06255 | 1 |
| 0.06256 | 1 |
| 0.06257 | 1 |
| 0.06258 | 1 |
| 0.06259 | 1 |
| 0.0626 | 1 |
| 0.06261 | 1 |
| 0.06262 | 1 |
| 0.06263 | 1 |
| 0.06264 | 1 |
| 0.06265 | 1 |
| 0.06266 | 1 |
| 0.06267 | 1 |
| 0.06268 | 1 |
| 0.06269 | 1 |
| 0.0627 | 1 |
| 0.06271 | 1 |
| 0.06272 | 1 |
| 0.06273 | 1 |
| 0.06274 | 1 |
| 0.06275 | 1 |
| 0.06276 | 1 |
| 0.06277 | 1 |
| 0.06278 | 1 |
| 0.06279 | 1 |
| 0.0628 | 1 |
| 0.06281 | 1 |
| 0.06282 | 1 |
| 0.06283 | 1 |
| 0.06284 | 1 |
| 0.06285 | 1 |
| 0.06286 | 1 |
| 0.06287 | 1 |
| 0.06288 | 1 |
| 0.06289 | 1 |
| 0.0629 | 1 |
| 0.06291 | 1 |
| 0.06292 | 1 |
| 0.06293 | 1 |
| 0.06294 | 1 |
| 0.06295 | 1 |
| 0.06296 | 1 |
| 0.06297 | 1 |
| 0.06298 | 1 |
| 0.06299 | 1 |
| 0.063 | 1 |
| 0.06301 | 1 |
| 0.06302 | 1 |
| 0.06303 | 1 |
| 0.06304 | 1 |
| 0.06305 | 1 |
| 0.06306 | 1 |
| 0.06307 | 1 |
| 0.06308 | 1 |
| 0.06309 | 1 |
| 0.0631 | 1 |
| 0.06311 | 1 |
| 0.06312 | 1 |
| 0.06313 | 1 |
| 0.06314 | 1 |
| 0.06315 | 1 |
| 0.06316 | 1 |
| 0.06317 | 1 |
| 0.06318 | 1 |
| 0.06319 | 1 |
| 0.0632 | 1 |
| 0.06321 | 1 |
| 0.06322 | 1 |
| 0.06323 | 1 |
| 0.06324 | 1 |
| 0.06325 | 1 |
| 0.06326 | 1 |
| 0.06327 | 1 |
| 0.06328 | 1 |
| 0.06329 | 1 |
| 0.0633 | 1 |
| 0.06331 | 1 |
| 0.06332 | 1 |
| 0.06333 | 1 |
| 0.06334 | 1 |
| 0.06335 | 1 |
| 0.06336 | 1 |
| 0.06337 | 1 |
| 0.06338 | 1 |
| 0.06339 | 1 |
| 0.0634 | 1 |
| 0.06341 | 1 |
| 0.06342 | 1 |
| 0.06343 | 1 |
| 0.06344 | 1 |
| 0.06345 | 1 |
| 0.06346 | 1 |
| 0.06347 | 1 |
| 0.06348 | 1 |
| 0.06349 | 1 |
| 0.0635 | 1 |
| 0.06351 | 1 |
| 0.06352 | 1 |
| 0.06353 | 1 |
| 0.06354 | 1 |
| 0.06355 | 1 |
| 0.06356 | 1 |
| 0.06357 | 1 |
| 0.06358 | 1 |
| 0.06359 | 1 |
| 0.0636 | 1 |
| 0.06361 | 1 |
| 0.06362 | 1 |
| 0.06363 | 1 |
| 0.06364 | 1 |
| 0.06365 | 1 |
| 0.06366 | 1 |
| 0.06367 | 1 |
| 0.06368 | 1 |
| 0.06369 | 1 |
| 0.0637 | 1 |
| 0.06371 | 1 |
| 0.06372 | 1 |
| 0.06373 | 1 |
| 0.06374 | 1 |
| 0.06375 | 1 |
| 0.06376 | 1 |
| 0.06377 | 1 |
| 0.06378 | 1 |
| 0.06379 | 1 |
| 0.0638 | 1 |
| 0.06381 | 1 |
| 0.06382 | 1 |
| 0.06383 | 1 |
| 0.06384 | 1 |
| 0.06385 | 1 |
| 0.06386 | 1 |
| 0.06387 | 1 |
| 0.06388 | 1 |
| 0.06389 | 1 |
| 0.0639 | 1 |
| 0.06391 | 1 |
| 0.06392 | 1 |
| 0.06393 | 1 |
| 0.06394 | 1 |
| 0.06395 | 1 |
| 0.06396 | 1 |
| 0.06397 | 1 |
| 0.06398 | 1 |
| 0.06399 | 1 |
| 0.064 | 1 |
| 0.06401 | 1 |
| 0.06402 | 1 |
| 0.06403 | 1 |
| 0.06404 | 1 |
| 0.06405 | 1 |
| 0.06406 | 1 |
| 0.06407 | 1 |
| 0.06408 | 1 |
| 0.06409 | 1 |
| 0.0641 | 1 |
| 0.06411 | 1 |
| 0.06412 | 1 |
| 0.06413 | 1 |
| 0.06414 | 1 |
| 0.06415 | 1 |
| 0.06416 | 1 |
| 0.06417 | 1 |
| 0.06418 | 1 |
| 0.06419 | 1 |
| 0.0642 | 1 |
| 0.06421 | 1 |
| 0.06422 | 1 |
| 0.06423 | 1 |
| 0.06424 | 1 |
| 0.06425 | 1 |
| 0.06426 | 1 |
| 0.06427 | 1 |
| 0.06428 | 1 |
| 0.06429 | 1 |
| 0.0643 | 1 |
| 0.06431 | 1 |
| 0.06432 | 1 |
| 0.06433 | 1 |
| 0.06434 | 1 |
| 0.06435 | 1 |
| 0.06436 | 1 |
| 0.06437 | 1 |
| 0.06438 | 1 |
| 0.06439 | 1 |
| 0.0644 | 1 |
| 0.06441 | 1 |
| 0.06442 | 1 |
| 0.06443 | 1 |
| 0.06444 | 1 |
| 0.06445 | 1 |
| 0.06446 | 1 |
| 0.06447 | 1 |
| 0.06448 | 1 |
| 0.06449 | 1 |
| 0.0645 | 1 |
| 0.06451 | 1 |
| 0.06452 | 1 |
| 0.06453 | 1 |
| 0.06454 | 1 |
| 0.06455 | 1 |
| 0.06456 | 1 |
| 0.06457 | 1 |
| 0.06458 | 1 |
| 0.06459 | 1 |
| 0.0646 | 1 |
| 0.06461 | 1 |
| 0.06462 | 1 |
| 0.06463 | 1 |
| 0.06464 | 1 |
| 0.06465 | 1 |
| 0.06466 | 1 |
| 0.06467 | 1 |
| 0.06468 | 1 |
| 0.06469 | 1 |
| 0.0647 | 1 |
| 0.06471 | 1 |
| 0.06472 | 1 |
| 0.06473 | 1 |
| 0.06474 | 1 |
| 0.06475 | 1 |
| 0.06476 | 1 |
| 0.06477 | 1 |
| 0.06478 | 1 |
| 0.06479 | 1 |
| 0.0648 | 1 |
| 0.06481 | 1 |
| 0.06482 | 1 |
| 0.06483 | 1 |
| 0.06484 | 1 |
| 0.06485 | 1 |
| 0.06486 | 1 |
| 0.06487 | 1 |
| 0.06488 | 1 |
| 0.06489 | 1 |
| 0.0649 | 1 |
| 0.06491 | 1 |
| 0.06492 | 1 |
| 0.06493 | 1 |
| 0.06494 | 1 |
| 0.06495 | 1 |
| 0.06496 | 1 |
| 0.06497 | 1 |
| 0.06498 | 1 |
| 0.06499 | 1 |
| 0.065 | 1 |
| 0.06501 | 1 |
| 0.06502 | 1 |
| 0.06503 | 1 |
| 0.06504 | 1 |
| 0.06505 | 1 |
| 0.06506 | 1 |
| 0.06507 | 1 |
| 0.06508 | 1 |
| 0.06509 | 1 |
| 0.0651 | 1 |
| 0.06511 | 1 |
| 0.06512 | 1 |
| 0.06513 | 1 |
| 0.06514 | 1 |
| 0.06515 | 1 |
| 0.06516 | 1 |
| 0.06517 | 1 |
| 0.06518 | 1 |
| 0.06519 | 1 |
| 0.0652 | 1 |
| 0.06521 | 1 |
| 0.06522 | 1 |
| 0.06523 | 1 |
| 0.06524 | 1 |
| 0.06525 | 1 |
| 0.06526 | 1 |
| 0.06527 | 1 |
| 0.06528 | 1 |
| 0.06529 | 1 |
| 0.0653 | 1 |
| 0.06531 | 1 |
| 0.06532 | 1 |
| 0.06533 | 1 |
| 0.06534 | 1 |
| 0.06535 | 1 |
| 0.06536 | 1 |
| 0.06537 | 1 |
| 0.06538 | 1 |
| 0.06539 | 1 |
| 0.0654 | 1 |
| 0.06541 | 1 |
| 0.06542 | 1 |
| 0.06543 | 1 |
| 0.06544 | 1 |
| 0.06545 | 1 |
| 0.06546 | 1 |
| 0.06547 | 1 |
| 0.06548 | 1 |
| 0.06549 | 1 |
| 0.0655 | 1 |
| 0.06551 | 1 |
| 0.06552 | 1 |
| 0.06553 | 1 |
| 0.06554 | 1 |
| 0.06555 | 1 |
| 0.06556 | 1 |
| 0.06557 | 1 |
| 0.06558 | 1 |
| 0.06559 | 1 |
| 0.0656 | 1 |
| 0.06561 | 1 |
| 0.06562 | 1 |
| 0.06563 | 1 |
| 0.06564 | 1 |
| 0.06565 | 1 |
| 0.06566 | 1 |
| 0.06567 | 1 |
| 0.06568 | 1 |
| 0.06569 | 1 |
| 0.0657 | 1 |
| 0.06571 | 1 |
| 0.06572 | 1 |
| 0.06573 | 1 |
| 0.06574 | 1 |
| 0.06575 | 1 |
| 0.06576 | 1 |
| 0.06577 | 1 |
| 0.06578 | 1 |
| 0.06579 | 1 |
| 0.0658 | 1 |
| 0.06581 | 1 |
| 0.06582 | 1 |
| 0.06583 | 1 |
| 0.06584 | 1 |
| 0.06585 | 1 |
| 0.06586 | 1 |
| 0.06587 | 1 |
| 0.06588 | 1 |
| 0.06589 | 1 |
| 0.0659 | 1 |
| 0.06591 | 1 |
| 0.06592 | 1 |
| 0.06593 | 1 |
| 0.06594 | 1 |
| 0.06595 | 1 |
| 0.06596 | 1 |
| 0.06597 | 1 |
| 0.06598 | 1 |
| 0.06599 | 1 |
| 0.066 | 1 |
| 0.06601 | 1 |
| 0.06602 | 1 |
| 0.06603 | 1 |
| 0.06604 | 1 |
| 0.06605 | 1 |
| 0.06606 | 1 |
| 0.06607 | 1 |
| 0.06608 | 1 |
| 0.06609 | 1 |
| 0.0661 | 1 |
| 0.06611 | 1 |
| 0.06612 | 1 |
| 0.06613 | 1 |
| 0.06614 | 1 |
| 0.06615 | 1 |
| 0.06616 | 1 |
| 0.06617 | 1 |
| 0.06618 | 1 |
| 0.06619 | 1 |
| 0.0662 | 1 |
| 0.06621 | 1 |
| 0.06622 | 1 |
| 0.06623 | 1 |
| 0.06624 | 1 |
| 0.06625 | 1 |
| 0.06626 | 1 |
| 0.06627 | 1 |
| 0.06628 | 1 |
| 0.06629 | 1 |
| 0.0663 | 1 |
| 0.06631 | 1 |
| 0.06632 | 1 |
| 0.06633 | 1 |
| 0.06634 | 1 |
| 0.06635 | 1 |
| 0.06636 | 1 |
| 0.06637 | 1 |
| 0.06638 | 1 |
| 0.06639 | 1 |
| 0.0664 | 1 |
| 0.06641 | 1 |
| 0.06642 | 1 |
| 0.06643 | 1 |
| 0.06644 | 1 |
| 0.06645 | 1 |
| 0.06646 | 1 |
| 0.06647 | 1 |
| 0.06648 | 1 |
| 0.06649 | 1 |
| 0.0665 | 1 |
| 0.06651 | 1 |
| 0.06652 | 1 |
| 0.06653 | 1 |
| 0.06654 | 1 |
| 0.06655 | 1 |
| 0.06656 | 1 |
| 0.06657 | 1 |
| 0.06658 | 1 |
| 0.06659 | 1 |
| 0.0666 | 1 |
| 0.06661 | 1 |
| 0.06662 | 1 |
| 0.06663 | 1 |
| 0.06664 | 1 |
| 0.06665 | 1 |
| 0.06666 | 1 |
| 0.06667 | 1 |
| 0.06668 | 1 |
| 0.06669 | 1 |
| 0.0667 | 1 |
| 0.06671 | 1 |
| 0.06672 | 1 |
| 0.06673 | 1 |
| 0.06674 | 1 |
| 0.06675 | 1 |
| 0.06676 | 1 |
| 0.06677 | 1 |
| 0.06678 | 1 |
| 0.06679 | 1 |
| 0.0668 | 1 |
| 0.06681 | 1 |
| 0.06682 | 1 |
| 0.06683 | 1 |
| 0.06684 | 1 |
| 0.06685 | 1 |
| 0.06686 | 1 |
| 0.06687 | 1 |
| 0.06688 | 1 |
| 0.06689 | 1 |
| 0.0669 | 1 |
| 0.06691 | 1 |
| 0.06692 | 1 |
| 0.06693 | 1 |
| 0.06694 | 1 |
| 0.06695 | 1 |
| 0.06696 | 1 |
| 0.06697 | 1 |
| 0.06698 | 1 |
| 0.06699 | 1 |
| 0.067 | 1 |
| 0.06701 | 1 |
| 0.06702 | 1 |
| 0.06703 | 1 |
| 0.06704 | 1 |
| 0.06705 | 1 |
| 0.06706 | 1 |
| 0.06707 | 1 |
| 0.06708 | 1 |
| 0.06709 | 1 |
| 0.0671 | 1 |
| 0.06711 | 1 |
| 0.06712 | 1 |
| 0.06713 | 1 |
| 0.06714 | 1 |
| 0.06715 | 1 |
| 0.06716 | 1 |
| 0.06717 | 1 |
| 0.06718 | 1 |
| 0.06719 | 1 |
| 0.0672 | 1 |
| 0.06721 | 1 |
| 0.06722 | 1 |
| 0.06723 | 1 |
| 0.06724 | 1 |
| 0.06725 | 1 |
| 0.06726 | 1 |
| 0.06727 | 1 |
| 0.06728 | 1 |
| 0.06729 | 1 |
| 0.0673 | 1 |
| 0.06731 | 1 |
| 0.06732 | 1 |
| 0.06733 | 1 |
| 0.06734 | 1 |
| 0.06735 | 1 |
| 0.06736 | 1 |
| 0.06737 | 1 |
| 0.06738 | 1 |
| 0.06739 | 1 |
| 0.0674 | 1 |
| 0.06741 | 1 |
| 0.06742 | 1 |
| 0.06743 | 1 |
| 0.06744 | 1 |
| 0.06745 | 1 |
| 0.06746 | 1 |
| 0.06747 | 1 |
| 0.06748 | 1 |
| 0.06749 | 1 |
| 0.0675 | 1 |
| 0.06751 | 1 |
| 0.06752 | 1 |
| 0.06753 | 1 |
| 0.06754 | 1 |
| 0.06755 | 1 |
| 0.06756 | 1 |
| 0.06757 | 1 |
| 0.06758 | 1 |
| 0.06759 | 1 |
| 0.0676 | 1 |
| 0.06761 | 1 |
| 0.06762 | 1 |
| 0.06763 | 1 |
| 0.06764 | 1 |
| 0.06765 | 1 |
| 0.06766 | 1 |
| 0.06767 | 1 |
| 0.06768 | 1 |
| 0.06769 | 1 |
| 0.0677 | 1 |
| 0.06771 | 1 |
| 0.06772 | 1 |
| 0.06773 | 1 |
| 0.06774 | 1 |
| 0.06775 | 1 |
| 0.06776 | 1 |
| 0.06777 | 1 |
| 0.06778 | 1 |
| 0.06779 | 1 |
| 0.0678 | 1 |
| 0.06781 | 1 |
| 0.06782 | 1 |
| 0.06783 | 1 |
| 0.06784 | 1 |
| 0.06785 | 1 |
| 0.06786 | 1 |
| 0.06787 | 1 |
| 0.06788 | 1 |
| 0.06789 | 1 |
| 0.0679 | 1 |
| 0.06791 | 1 |
| 0.06792 | 1 |
| 0.06793 | 1 |
| 0.06794 | 1 |
| 0.06795 | 1 |
| 0.06796 | 1 |
| 0.06797 | 1 |
| 0.06798 | 1 |
| 0.06799 | 1 |
| 0.068 | 1 |
| 0.06801 | 1 |
| 0.06802 | 1 |
| 0.06803 | 1 |
| 0.06804 | 1 |
| 0.06805 | 1 |
| 0.06806 | 1 |
| 0.06807 | 1 |
| 0.06808 | 1 |
| 0.06809 | 1 |
| 0.0681 | 1 |
| 0.06811 | 1 |
| 0.06812 | 1 |
| 0.06813 | 1 |
| 0.06814 | 1 |
| 0.06815 | 1 |
| 0.06816 | 1 |
| 0.06817 | 1 |
| 0.06818 | 1 |
| 0.06819 | 1 |
| 0.0682 | 1 |
| 0.06821 | 1 |
| 0.06822 | 1 |
| 0.06823 | 1 |
| 0.06824 | 1 |
| 0.06825 | 1 |
| 0.06826 | 1 |
| 0.06827 | 1 |
| 0.06828 | 1 |
| 0.06829 | 1 |
| 0.0683 | 1 |
| 0.06831 | 1 |
| 0.06832 | 1 |
| 0.06833 | 1 |
| 0.06834 | 1 |
| 0.06835 | 1 |
| 0.06836 | 1 |
| 0.06837 | 1 |
| 0.06838 | 1 |
| 0.06839 | 1 |
| 0.0684 | 1 |
| 0.06841 | 1 |
| 0.06842 | 1 |
| 0.06843 | 1 |
| 0.06844 | 1 |
| 0.06845 | 1 |
| 0.06846 | 1 |
| 0.06847 | 1 |
| 0.06848 | 1 |
| 0.06849 | 1 |
| 0.0685 | 1 |
| 0.06851 | 1 |
| 0.06852 | 1 |
| 0.06853 | 1 |
| 0.06854 | 1 |
| 0.06855 | 1 |
| 0.06856 | 1 |
| 0.06857 | 1 |
| 0.06858 | 1 |
| 0.06859 | 1 |
| 0.0686 | 1 |
| 0.06861 | 1 |
| 0.06862 | 1 |
| 0.06863 | 1 |
| 0.06864 | 1 |
| 0.06865 | 1 |
| 0.06866 | 1 |
| 0.06867 | 1 |
| 0.06868 | 1 |
| 0.06869 | 1 |
| 0.0687 | 1 |
| 0.06871 | 1 |
| 0.06872 | 1 |
| 0.06873 | 1 |
| 0.06874 | 1 |
| 0.06875 | 1 |
| 0.06876 | 1 |
| 0.06877 | 1 |
| 0.06878 | 1 |
| 0.06879 | 1 |
| 0.0688 | 1 |
| 0.06881 | 1 |
| 0.06882 | 1 |
| 0.06883 | 1 |
| 0.06884 | 1 |
| 0.06885 | 1 |
| 0.06886 | 1 |
| 0.06887 | 1 |
| 0.06888 | 1 |
| 0.06889 | 1 |
| 0.0689 | 1 |
| 0.06891 | 1 |
| 0.06892 | 1 |
| 0.06893 | 1 |
| 0.06894 | 1 |
| 0.06895 | 1 |
| 0.06896 | 1 |
| 0.06897 | 1 |
| 0.06898 | 1 |
| 0.06899 | 1 |
| 0.069 | 1 |
| 0.06901 | 1 |
| 0.06902 | 1 |
| 0.06903 | 1 |
| 0.06904 | 1 |
| 0.06905 | 1 |
| 0.06906 | 1 |
| 0.06907 | 1 |
| 0.06908 | 1 |
| 0.06909 | 1 |
| 0.0691 | 1 |
| 0.06911 | 1 |
| 0.06912 | 1 |
| 0.06913 | 1 |
| 0.06914 | 1 |
| 0.06915 | 1 |
| 0.06916 | 1 |
| 0.06917 | 1 |
| 0.06918 | 1 |
| 0.06919 | 1 |
| 0.0692 | 1 |
| 0.06921 | 1 |
| 0.06922 | 1 |
| 0.06923 | 1 |
| 0.06924 | 1 |
| 0.06925 | 1 |
| 0.06926 | 1 |
| 0.06927 | 1 |
| 0.06928 | 1 |
| 0.06929 | 1 |
| 0.0693 | 1 |
| 0.06931 | 1 |
| 0.06932 | 1 |
| 0.06933 | 1 |
| 0.06934 | 1 |
| 0.06935 | 1 |
| 0.06936 | 1 |
| 0.06937 | 1 |
| 0.06938 | 1 |
| 0.06939 | 1 |
| 0.0694 | 1 |
| 0.06941 | 1 |
| 0.06942 | 1 |
| 0.06943 | 1 |
| 0.06944 | 1 |
| 0.06945 | 1 |
| 0.06946 | 1 |
| 0.06947 | 1 |
| 0.06948 | 1 |
| 0.06949 | 1 |
| 0.0695 | 1 |
| 0.06951 | 1 |
| 0.06952 | 1 |
| 0.06953 | 1 |
| 0.06954 | 1 |
| 0.06955 | 1 |
| 0.06956 | 1 |
| 0.06957 | 1 |
| 0.06958 | 1 |
| 0.06959 | 1 |
| 0.0696 | 1 |
| 0.06961 | 1 |
| 0.06962 | 1 |
| 0.06963 | 1 |
| 0.06964 | 1 |
| 0.06965 | 1 |
| 0.06966 | 1 |
| 0.06967 | 1 |
| 0.06968 | 1 |
| 0.06969 | 1 |
| 0.0697 | 1 |
| 0.06971 | 1 |
| 0.06972 | 1 |
| 0.06973 | 1 |
| 0.06974 | 1 |
| 0.06975 | 1 |
| 0.06976 | 1 |
| 0.06977 | 1 |
| 0.06978 | 1 |
| 0.06979 | 1 |
| 0.0698 | 1 |
| 0.06981 | 1 |
| 0.06982 | 1 |
| 0.06983 | 1 |
| 0.06984 | 1 |
| 0.06985 | 1 |
| 0.06986 | 1 |
| 0.06987 | 1 |
| 0.06988 | 1 |
| 0.06989 | 1 |
| 0.0699 | 1 |
| 0.06991 | 1 |
| 0.06992 | 1 |
| 0.06993 | 1 |
| 0.06994 | 1 |
| 0.06995 | 1 |
| 0.06996 | 1 |
| 0.06997 | 1 |
| 0.06998 | 1 |
| 0.06999 | 1 |
| 0.07 | 1 |
| 0.07001 | 1 |
| 0.07002 | 1 |
| 0.07003 | 1 |
| 0.07004 | 1 |
| 0.07005 | 1 |
| 0.07006 | 1 |
| 0.07007 | 1 |
| 0.07008 | 1 |
| 0.07009 | 1 |
| 0.0701 | 1 |
| 0.07011 | 1 |
| 0.07012 | 1 |
| 0.07013 | 1 |
| 0.07014 | 1 |
| 0.07015 | 1 |
| 0.07016 | 1 |
| 0.07017 | 1 |
| 0.07018 | 1 |
| 0.07019 | 1 |
| 0.0702 | 1 |
| 0.07021 | 1 |
| 0.07022 | 1 |
| 0.07023 | 1 |
| 0.07024 | 1 |
| 0.07025 | 1 |
| 0.07026 | 1 |
| 0.07027 | 1 |
| 0.07028 | 1 |
| 0.07029 | 1 |
| 0.0703 | 1 |
| 0.07031 | 1 |
| 0.07032 | 1 |
| 0.07033 | 1 |
| 0.07034 | 1 |
| 0.07035 | 1 |
| 0.07036 | 1 |
| 0.07037 | 1 |
| 0.07038 | 1 |
| 0.07039 | 1 |
| 0.0704 | 1 |
| 0.07041 | 1 |
| 0.07042 | 1 |
| 0.07043 | 1 |
| 0.07044 | 1 |
| 0.07045 | 1 |
| 0.07046 | 1 |
| 0.07047 | 1 |
| 0.07048 | 1 |
| 0.07049 | 1 |
| 0.0705 | 1 |
| 0.07051 | 1 |
| 0.07052 | 1 |
| 0.07053 | 1 |
| 0.07054 | 1 |
| 0.07055 | 1 |
| 0.07056 | 1 |
| 0.07057 | 1 |
| 0.07058 | 1 |
| 0.07059 | 1 |
| 0.0706 | 1 |
| 0.07061 | 1 |
| 0.07062 | 1 |
| 0.07063 | 1 |
| 0.07064 | 1 |
| 0.07065 | 1 |
| 0.07066 | 1 |
| 0.07067 | 1 |
| 0.07068 | 1 |
| 0.07069 | 1 |
| 0.0707 | 1 |
| 0.07071 | 1 |
| 0.07072 | 1 |
| 0.07073 | 1 |
| 0.07074 | 1 |
| 0.07075 | 1 |
| 0.07076 | 1 |
| 0.07077 | 1 |
| 0.07078 | 1 |
| 0.07079 | 1 |
| 0.0708 | 1 |
| 0.07081 | 1 |
| 0.07082 | 1 |
| 0.07083 | 1 |
| 0.07084 | 1 |
| 0.07085 | 1 |
| 0.07086 | 1 |
| 0.07087 | 1 |
| 0.07088 | 1 |
| 0.07089 | 1 |
| 0.0709 | 1 |
| 0.07091 | 1 |
| 0.07092 | 1 |
| 0.07093 | 1 |
| 0.07094 | 1 |
| 0.07095 | 1 |
| 0.07096 | 1 |
| 0.07097 | 1 |
| 0.07098 | 1 |
| 0.07099 | 1 |
| 0.071 | 1 |
| 0.07101 | 1 |
| 0.07102 | 1 |
| 0.07103 | 1 |
| 0.07104 | 1 |
| 0.07105 | 1 |
| 0.07106 | 1 |
| 0.07107 | 1 |
| 0.07108 | 1 |
| 0.07109 | 1 |
| 0.0711 | 1 |
| 0.07111 | 1 |
| 0.07112 | 1 |
| 0.07113 | 1 |
| 0.07114 | 1 |
| 0.07115 | 1 |
| 0.07116 | 1 |
| 0.07117 | 1 |
| 0.07118 | 1 |
| 0.07119 | 1 |
| 0.0712 | 1 |
| 0.07121 | 1 |
| 0.07122 | 1 |
| 0.07123 | 1 |
| 0.07124 | 1 |
| 0.07125 | 1 |
| 0.07126 | 1 |
| 0.07127 | 1 |
| 0.07128 | 1 |
| 0.07129 | 1 |
| 0.0713 | 1 |
| 0.07131 | 1 |
| 0.07132 | 1 |
| 0.07133 | 1 |
| 0.07134 | 1 |
| 0.07135 | 1 |
| 0.07136 | 1 |
| 0.07137 | 1 |
| 0.07138 | 1 |
| 0.07139 | 1 |
| 0.0714 | 1 |
| 0.07141 | 1 |
| 0.07142 | 1 |
| 0.07143 | 1 |
| 0.07144 | 1 |
| 0.07145 | 1 |
| 0.07146 | 1 |
| 0.07147 | 1 |
| 0.07148 | 1 |
| 0.07149 | 1 |
| 0.0715 | 1 |
| 0.07151 | 1 |
| 0.07152 | 1 |
| 0.07153 | 1 |
| 0.07154 | 1 |
| 0.07155 | 1 |
| 0.07156 | 1 |
| 0.07157 | 1 |
| 0.07158 | 1 |
| 0.07159 | 1 |
| 0.0716 | 1 |
| 0.07161 | 1 |
| 0.07162 | 1 |
| 0.07163 | 1 |
| 0.07164 | 1 |
| 0.07165 | 1 |
| 0.07166 | 1 |
| 0.07167 | 1 |
| 0.07168 | 1 |
| 0.07169 | 1 |
| 0.0717 | 1 |
| 0.07171 | 1 |
| 0.07172 | 1 |
| 0.07173 | 1 |
| 0.07174 | 1 |
| 0.07175 | 1 |
| 0.07176 | 1 |
| 0.07177 | 1 |
| 0.07178 | 1 |
| 0.07179 | 1 |
| 0.0718 | 1 |
| 0.07181 | 1 |
| 0.07182 | 1 |
| 0.07183 | 1 |
| 0.07184 | 1 |
| 0.07185 | 1 |
| 0.07186 | 1 |
| 0.07187 | 1 |
| 0.07188 | 1 |
| 0.07189 | 1 |
| 0.0719 | 1 |
| 0.07191 | 1 |
| 0.07192 | 1 |
| 0.07193 | 1 |
| 0.07194 | 1 |
| 0.07195 | 1 |
| 0.07196 | 1 |
| 0.07197 | 1 |
| 0.07198 | 1 |
| 0.07199 | 1 |
| 0.072 | 1 |
| 0.07201 | 1 |
| 0.07202 | 1 |
| 0.07203 | 1 |
| 0.07204 | 1 |
| 0.07205 | 1 |
| 0.07206 | 1 |
| 0.07207 | 1 |
| 0.07208 | 1 |
| 0.07209 | 1 |
| 0.0721 | 1 |
| 0.07211 | 1 |
| 0.07212 | 1 |
| 0.07213 | 1 |
| 0.07214 | 1 |
| 0.07215 | 1 |
| 0.07216 | 1 |
| 0.07217 | 1 |
| 0.07218 | 1 |
| 0.07219 | 1 |
| 0.0722 | 1 |
| 0.07221 | 1 |
| 0.07222 | 1 |
| 0.07223 | 1 |
| 0.07224 | 1 |
| 0.07225 | 1 |
| 0.07226 | 1 |
| 0.07227 | 1 |
| 0.07228 | 1 |
| 0.07229 | 1 |
| 0.0723 | 1 |
| 0.07231 | 1 |
| 0.07232 | 1 |
| 0.07233 | 1 |
| 0.07234 | 1 |
| 0.07235 | 1 |
| 0.07236 | 1 |
| 0.07237 | 1 |
| 0.07238 | 1 |
| 0.07239 | 1 |
| 0.0724 | 1 |
| 0.07241 | 1 |
| 0.07242 | 1 |
| 0.07243 | 1 |
| 0.07244 | 1 |
| 0.07245 | 1 |
| 0.07246 | 1 |
| 0.07247 | 1 |
| 0.07248 | 1 |
| 0.07249 | 1 |
| 0.0725 | 1 |
| 0.07251 | 1 |
| 0.07252 | 1 |
| 0.07253 | 1 |
| 0.07254 | 1 |
| 0.07255 | 1 |
| 0.07256 | 1 |
| 0.07257 | 1 |
| 0.07258 | 1 |
| 0.07259 | 1 |
| 0.0726 | 1 |
| 0.07261 | 1 |
| 0.07262 | 1 |
| 0.07263 | 1 |
| 0.07264 | 1 |
| 0.07265 | 1 |
| 0.07266 | 1 |
| 0.07267 | 1 |
| 0.07268 | 1 |
| 0.07269 | 1 |
| 0.0727 | 1 |
| 0.07271 | 1 |
| 0.07272 | 1 |
| 0.07273 | 1 |
| 0.07274 | 1 |
| 0.07275 | 1 |
| 0.07276 | 1 |
| 0.07277 | 1 |
| 0.07278 | 1 |
| 0.07279 | 1 |
| 0.0728 | 1 |
| 0.07281 | 1 |
| 0.07282 | 1 |
| 0.07283 | 1 |
| 0.07284 | 1 |
| 0.07285 | 1 |
| 0.07286 | 1 |
| 0.07287 | 1 |
| 0.07288 | 1 |
| 0.07289 | 1 |
| 0.0729 | 1 |
| 0.07291 | 1 |
| 0.07292 | 1 |
| 0.07293 | 1 |
| 0.07294 | 1 |
| 0.07295 | 1 |
| 0.07296 | 1 |
| 0.07297 | 1 |
| 0.07298 | 1 |
| 0.07299 | 1 |
| 0.073 | 1 |
| 0.07301 | 1 |
| 0.07302 | 1 |
| 0.07303 | 1 |
| 0.07304 | 1 |
| 0.07305 | 1 |
| 0.07306 | 1 |
| 0.07307 | 1 |
| 0.07308 | 1 |
| 0.07309 | 1 |
| 0.0731 | 1 |
| 0.07311 | 1 |
| 0.07312 | 1 |
| 0.07313 | 1 |
| 0.07314 | 1 |
| 0.07315 | 1 |
| 0.07316 | 1 |
| 0.07317 | 1 |
| 0.07318 | 1 |
| 0.07319 | 1 |
| 0.0732 | 1 |
| 0.07321 | 1 |
| 0.07322 | 1 |
| 0.07323 | 1 |
| 0.07324 | 1 |
| 0.07325 | 1 |
| 0.07326 | 1 |
| 0.07327 | 1 |
| 0.07328 | 1 |
| 0.07329 | 1 |
| 0.0733 | 1 |
| 0.07331 | 1 |
| 0.07332 | 1 |
| 0.07333 | 1 |
| 0.07334 | 1 |
| 0.07335 | 1 |
| 0.07336 | 1 |
| 0.07337 | 1 |
| 0.07338 | 1 |
| 0.07339 | 1 |
| 0.0734 | 1 |
| 0.07341 | 1 |
| 0.07342 | 1 |
| 0.07343 | 1 |
| 0.07344 | 1 |
| 0.07345 | 1 |
| 0.07346 | 1 |
| 0.07347 | 1 |
| 0.07348 | 1 |
| 0.07349 | 1 |
| 0.0735 | 1 |
| 0.07351 | 1 |
| 0.07352 | 1 |
| 0.07353 | 1 |
| 0.07354 | 1 |
| 0.07355 | 1 |
| 0.07356 | 1 |
| 0.07357 | 1 |
| 0.07358 | 1 |
| 0.07359 | 1 |
| 0.0736 | 1 |
| 0.07361 | 1 |
| 0.07362 | 1 |
| 0.07363 | 1 |
| 0.07364 | 1 |
| 0.07365 | 1 |
| 0.07366 | 1 |
| 0.07367 | 1 |
| 0.07368 | 1 |
| 0.07369 | 1 |
| 0.0737 | 1 |
| 0.07371 | 1 |
| 0.07372 | 1 |
| 0.07373 | 1 |
| 0.07374 | 1 |
| 0.07375 | 1 |
| 0.07376 | 1 |
| 0.07377 | 1 |
| 0.07378 | 1 |
| 0.07379 | 1 |
| 0.0738 | 1 |
| 0.07381 | 1 |
| 0.07382 | 1 |
| 0.07383 | 1 |
| 0.07384 | 1 |
| 0.07385 | 1 |
| 0.07386 | 1 |
| 0.07387 | 1 |
| 0.07388 | 1 |
| 0.07389 | 1 |
| 0.0739 | 1 |
| 0.07391 | 1 |
| 0.07392 | 1 |
| 0.07393 | 1 |
| 0.07394 | 1 |
| 0.07395 | 1 |
| 0.07396 | 1 |
| 0.07397 | 1 |
| 0.07398 | 1 |
| 0.07399 | 1 |
| 0.074 | 1 |
| 0.07401 | 1 |
| 0.07402 | 1 |
| 0.07403 | 1 |
| 0.07404 | 1 |
| 0.07405 | 1 |
| 0.07406 | 1 |
| 0.07407 | 1 |
| 0.07408 | 1 |
| 0.07409 | 1 |
| 0.0741 | 1 |
| 0.07411 | 1 |
| 0.07412 | 1 |
| 0.07413 | 1 |
| 0.07414 | 1 |
| 0.07415 | 1 |
| 0.07416 | 1 |
| 0.07417 | 1 |
| 0.07418 | 1 |
| 0.07419 | 1 |
| 0.0742 | 1 |
| 0.07421 | 1 |
| 0.07422 | 1 |
| 0.07423 | 1 |
| 0.07424 | 1 |
| 0.07425 | 1 |
| 0.07426 | 1 |
| 0.07427 | 1 |
| 0.07428 | 1 |
| 0.07429 | 1 |
| 0.0743 | 1 |
| 0.07431 | 1 |
| 0.07432 | 1 |
| 0.07433 | 1 |
| 0.07434 | 1 |
| 0.07435 | 1 |
| 0.07436 | 1 |
| 0.07437 | 1 |
| 0.07438 | 1 |
| 0.07439 | 1 |
| 0.0744 | 1 |
| 0.07441 | 1 |
| 0.07442 | 1 |
| 0.07443 | 1 |
| 0.07444 | 1 |
| 0.07445 | 1 |
| 0.07446 | 1 |
| 0.07447 | 1 |
| 0.07448 | 1 |
| 0.07449 | 1 |
| 0.0745 | 1 |
| 0.07451 | 1 |
| 0.07452 | 1 |
| 0.07453 | 1 |
| 0.07454 | 1 |
| 0.07455 | 1 |
| 0.07456 | 1 |
| 0.07457 | 1 |
| 0.07458 | 1 |
| 0.07459 | 1 |
| 0.0746 | 1 |
| 0.07461 | 1 |
| 0.07462 | 1 |
| 0.07463 | 1 |
| 0.07464 | 1 |
| 0.07465 | 1 |
| 0.07466 | 1 |
| 0.07467 | 1 |
| 0.07468 | 1 |
| 0.07469 | 1 |
| 0.0747 | 1 |
| 0.07471 | 1 |
| 0.07472 | 1 |
| 0.07473 | 1 |
| 0.07474 | 1 |
| 0.07475 | 1 |
| 0.07476 | 1 |
| 0.07477 | 1 |
| 0.07478 | 1 |
| 0.07479 | 1 |
| 0.0748 | 1 |
| 0.07481 | 1 |
| 0.07482 | 1 |
| 0.07483 | 1 |
| 0.07484 | 1 |
| 0.07485 | 1 |
| 0.07486 | 1 |
| 0.07487 | 1 |
| 0.07488 | 1 |
| 0.07489 | 1 |
| 0.0749 | 1 |
| 0.07491 | 1 |
| 0.07492 | 1 |
| 0.07493 | 1 |
| 0.07494 | 1 |
| 0.07495 | 1 |
| 0.07496 | 1 |
| 0.07497 | 1 |
| 0.07498 | 1 |
| 0.07499 | 1 |
| 0.075 | 1 |
| 0.07501 | 1 |
| 0.07502 | 1 |
| 0.07503 | 1 |
| 0.07504 | 1 |
| 0.07505 | 1 |
| 0.07506 | 1 |
| 0.07507 | 1 |
| 0.07508 | 1 |
| 0.07509 | 0.999 |
| 0.0751 | 0.999 |
| 0.07511 | 0.999 |
| 0.07512 | 0.999 |
| 0.07513 | 0.999 |
| 0.07514 | 0.999 |
| 0.07515 | 0.999 |
| 0.07516 | 0.999 |
| 0.07517 | 0.999 |
| 0.07518 | 0.999 |
| 0.07519 | 0.999 |
| 0.0752 | 0.999 |
| 0.07521 | 0.999 |
| 0.07522 | 0.999 |
| 0.07523 | 0.999 |
| 0.07524 | 0.999 |
| 0.07525 | 0.999 |
| 0.07526 | 0.999 |
| 0.07527 | 0.999 |
| 0.07528 | 0.999 |
| 0.07529 | 0.999 |
| 0.0753 | 0.999 |
| 0.07531 | 0.999 |
| 0.07532 | 0.999 |
| 0.07533 | 0.999 |
| 0.07534 | 0.999 |
| 0.07535 | 0.999 |
| 0.07536 | 0.999 |
| 0.07537 | 0.999 |
| 0.07538 | 0.999 |
| 0.07539 | 0.999 |
| 0.0754 | 0.999 |
| 0.07541 | 0.999 |
| 0.07542 | 0.999 |
| 0.07543 | 0.999 |
| 0.07544 | 0.999 |
| 0.07545 | 0.999 |
| 0.07546 | 0.999 |
| 0.07547 | 0.999 |
| 0.07548 | 0.999 |
| 0.07549 | 0.999 |
| 0.0755 | 0.999 |
| 0.07551 | 0.999 |
| 0.07552 | 0.999 |
| 0.07553 | 0.999 |
| 0.07554 | 0.999 |
| 0.07555 | 0.999 |
| 0.07556 | 0.999 |
| 0.07557 | 0.999 |
| 0.07558 | 0.999 |
| 0.07559 | 0.999 |
| 0.0756 | 0.999 |
| 0.07561 | 0.999 |
| 0.07562 | 0.999 |
| 0.07563 | 0.999 |
| 0.07564 | 0.999 |
| 0.07565 | 0.999 |
| 0.07566 | 0.999 |
| 0.07567 | 0.999 |
| 0.07568 | 0.999 |
| 0.07569 | 0.999 |
| 0.0757 | 0.999 |
| 0.07571 | 0.999 |
| 0.07572 | 0.999 |
| 0.07573 | 0.999 |
| 0.07574 | 0.999 |
| 0.07575 | 0.999 |
| 0.07576 | 0.999 |
| 0.07577 | 0.999 |
| 0.07578 | 0.999 |
| 0.07579 | 0.999 |
| 0.0758 | 0.999 |
| 0.07581 | 0.999 |
| 0.07582 | 0.999 |
| 0.07583 | 0.999 |
| 0.07584 | 0.999 |
| 0.07585 | 0.999 |
| 0.07586 | 0.999 |
| 0.07587 | 0.999 |
| 0.07588 | 0.999 |
| 0.07589 | 0.999 |
| 0.0759 | 0.999 |
| 0.07591 | 0.999 |
| 0.07592 | 0.999 |
| 0.07593 | 0.999 |
| 0.07594 | 0.999 |
| 0.07595 | 0.999 |
| 0.07596 | 0.999 |
| 0.07597 | 0.999 |
| 0.07598 | 0.999 |
| 0.07599 | 0.999 |
| 0.076 | 0.999 |
| 0.07601 | 0.999 |
| 0.07602 | 0.999 |
| 0.07603 | 0.999 |
| 0.07604 | 0.999 |
| 0.07605 | 0.999 |
| 0.07606 | 0.999 |
| 0.07607 | 0.999 |
| 0.07608 | 0.999 |
| 0.07609 | 0.999 |
| 0.0761 | 0.999 |
| 0.07611 | 0.999 |
| 0.07612 | 0.999 |
| 0.07613 | 0.999 |
| 0.07614 | 0.999 |
| 0.07615 | 0.999 |
| 0.07616 | 0.999 |
| 0.07617 | 0.999 |
| 0.07618 | 0.999 |
| 0.07619 | 0.999 |
| 0.0762 | 0.999 |
| 0.07621 | 0.999 |
| 0.07622 | 0.999 |
| 0.07623 | 0.999 |
| 0.07624 | 0.999 |
| 0.07625 | 0.999 |
| 0.07626 | 0.999 |
| 0.07627 | 0.999 |
| 0.07628 | 0.999 |
| 0.07629 | 0.999 |
| 0.0763 | 0.999 |
| 0.07631 | 0.999 |
| 0.07632 | 0.999 |
| 0.07633 | 0.999 |
| 0.07634 | 0.999 |
| 0.07635 | 0.999 |
| 0.07636 | 0.999 |
| 0.07637 | 0.999 |
| 0.07638 | 0.999 |
| 0.07639 | 0.999 |
| 0.0764 | 0.999 |
| 0.07641 | 0.999 |
| 0.07642 | 0.999 |
| 0.07643 | 0.999 |
| 0.07644 | 0.999 |
| 0.07645 | 0.999 |
| 0.07646 | 0.999 |
| 0.07647 | 0.999 |
| 0.07648 | 0.999 |
| 0.07649 | 0.999 |
| 0.0765 | 0.999 |
| 0.07651 | 0.999 |
| 0.07652 | 0.999 |
| 0.07653 | 0.999 |
| 0.07654 | 0.999 |
| 0.07655 | 0.999 |
| 0.07656 | 0.999 |
| 0.07657 | 0.999 |
| 0.07658 | 0.999 |
| 0.07659 | 0.999 |
| 0.0766 | 0.999 |
| 0.07661 | 0.999 |
| 0.07662 | 0.999 |
| 0.07663 | 0.999 |
| 0.07664 | 0.999 |
| 0.07665 | 0.999 |
| 0.07666 | 0.999 |
| 0.07667 | 0.999 |
| 0.07668 | 0.999 |
| 0.07669 | 0.999 |
| 0.0767 | 0.999 |
| 0.07671 | 0.999 |
| 0.07672 | 0.999 |
| 0.07673 | 0.999 |
| 0.07674 | 0.999 |
| 0.07675 | 0.999 |
| 0.07676 | 0.999 |
| 0.07677 | 0.999 |
| 0.07678 | 0.999 |
| 0.07679 | 0.999 |
| 0.0768 | 0.999 |
| 0.07681 | 0.999 |
| 0.07682 | 0.999 |
| 0.07683 | 0.999 |
| 0.07684 | 0.999 |
| 0.07685 | 0.999 |
| 0.07686 | 0.999 |
| 0.07687 | 0.999 |
| 0.07688 | 0.999 |
| 0.07689 | 0.999 |
| 0.0769 | 0.999 |
| 0.07691 | 0.999 |
| 0.07692 | 0.999 |
| 0.07693 | 0.999 |
| 0.07694 | 0.999 |
| 0.07695 | 0.999 |
| 0.07696 | 0.999 |
| 0.07697 | 0.999 |
| 0.07698 | 0.999 |
| 0.07699 | 0.999 |
| 0.077 | 0.999 |
| 0.07701 | 0.999 |
| 0.07702 | 0.999 |
| 0.07703 | 0.999 |
| 0.07704 | 0.999 |
| 0.07705 | 0.999 |
| 0.07706 | 0.999 |
| 0.07707 | 0.999 |
| 0.07708 | 0.999 |
| 0.07709 | 0.999 |
| 0.0771 | 0.999 |
| 0.07711 | 0.999 |
| 0.07712 | 0.999 |
| 0.07713 | 0.999 |
| 0.07714 | 0.999 |
| 0.07715 | 0.999 |
| 0.07716 | 0.999 |
| 0.07717 | 0.999 |
| 0.07718 | 0.999 |
| 0.07719 | 0.999 |
| 0.0772 | 0.999 |
| 0.07721 | 0.999 |
| 0.07722 | 0.999 |
| 0.07723 | 0.999 |
| 0.07724 | 0.999 |
| 0.07725 | 0.999 |
| 0.07726 | 0.999 |
| 0.07727 | 0.999 |
| 0.07728 | 0.999 |
| 0.07729 | 0.999 |
| 0.0773 | 0.999 |
| 0.07731 | 0.999 |
| 0.07732 | 0.999 |
| 0.07733 | 0.999 |
| 0.07734 | 0.999 |
| 0.07735 | 0.999 |
| 0.07736 | 0.999 |
| 0.07737 | 0.999 |
| 0.07738 | 0.999 |
| 0.07739 | 0.999 |
| 0.0774 | 0.999 |
| 0.07741 | 0.999 |
| 0.07742 | 0.999 |
| 0.07743 | 0.999 |
| 0.07744 | 0.999 |
| 0.07745 | 0.999 |
| 0.07746 | 0.999 |
| 0.07747 | 0.999 |
| 0.07748 | 0.999 |
| 0.07749 | 0.999 |
| 0.0775 | 0.999 |
| 0.07751 | 0.999 |
| 0.07752 | 0.999 |
| 0.07753 | 0.999 |
| 0.07754 | 0.999 |
| 0.07755 | 0.999 |
| 0.07756 | 0.999 |
| 0.07757 | 0.999 |
| 0.07758 | 0.999 |
| 0.07759 | 0.999 |
| 0.0776 | 0.999 |
| 0.07761 | 0.999 |
| 0.07762 | 0.999 |
| 0.07763 | 0.999 |
| 0.07764 | 0.999 |
| 0.07765 | 0.999 |
| 0.07766 | 0.999 |
| 0.07767 | 0.999 |
| 0.07768 | 0.999 |
| 0.07769 | 0.999 |
| 0.0777 | 0.999 |
| 0.07771 | 0.999 |
| 0.07772 | 0.999 |
| 0.07773 | 0.999 |
| 0.07774 | 0.999 |
| 0.07775 | 0.999 |
| 0.07776 | 0.999 |
| 0.07777 | 0.999 |
| 0.07778 | 0.999 |
| 0.07779 | 0.999 |
| 0.0778 | 0.999 |
| 0.07781 | 0.999 |
| 0.07782 | 0.999 |
| 0.07783 | 0.999 |
| 0.07784 | 0.999 |
| 0.07785 | 0.999 |
| 0.07786 | 0.999 |
| 0.07787 | 0.999 |
| 0.07788 | 0.999 |
| 0.07789 | 0.999 |
| 0.0779 | 0.999 |
| 0.07791 | 0.999 |
| 0.07792 | 0.999 |
| 0.07793 | 0.999 |
| 0.07794 | 0.999 |
| 0.07795 | 0.999 |
| 0.07796 | 0.999 |
| 0.07797 | 0.999 |
| 0.07798 | 0.999 |
| 0.07799 | 0.999 |
| 0.078 | 0.999 |
| 0.07801 | 0.999 |
| 0.07802 | 0.999 |
| 0.07803 | 0.999 |
| 0.07804 | 0.999 |
| 0.07805 | 0.999 |
| 0.07806 | 0.999 |
| 0.07807 | 0.999 |
| 0.07808 | 0.999 |
| 0.07809 | 0.999 |
| 0.0781 | 0.999 |
| 0.07811 | 0.999 |
| 0.07812 | 0.999 |
| 0.07813 | 0.999 |
| 0.07814 | 0.999 |
| 0.07815 | 0.999 |
| 0.07816 | 0.999 |
| 0.07817 | 0.999 |
| 0.07818 | 0.999 |
| 0.07819 | 0.999 |
| 0.0782 | 0.999 |
| 0.07821 | 0.999 |
| 0.07822 | 0.999 |
| 0.07823 | 0.999 |
| 0.07824 | 0.999 |
| 0.07825 | 0.999 |
| 0.07826 | 0.999 |
| 0.07827 | 0.999 |
| 0.07828 | 0.999 |
| 0.07829 | 0.999 |
| 0.0783 | 0.999 |
| 0.07831 | 0.999 |
| 0.07832 | 0.999 |
| 0.07833 | 0.999 |
| 0.07834 | 0.999 |
| 0.07835 | 0.999 |
| 0.07836 | 0.999 |
| 0.07837 | 0.999 |
| 0.07838 | 0.999 |
| 0.07839 | 0.999 |
| 0.0784 | 0.999 |
| 0.07841 | 0.999 |
| 0.07842 | 0.999 |
| 0.07843 | 0.999 |
| 0.07844 | 0.999 |
| 0.07845 | 0.999 |
| 0.07846 | 0.999 |
| 0.07847 | 0.999 |
| 0.07848 | 0.999 |
| 0.07849 | 0.999 |
| 0.0785 | 0.999 |
| 0.07851 | 0.999 |
| 0.07852 | 0.999 |
| 0.07853 | 0.999 |
| 0.07854 | 0.999 |
| 0.07855 | 0.999 |
| 0.07856 | 0.999 |
| 0.07857 | 0.999 |
| 0.07858 | 0.999 |
| 0.07859 | 0.999 |
| 0.0786 | 0.999 |
| 0.07861 | 0.999 |
| 0.07862 | 0.999 |
| 0.07863 | 0.999 |
| 0.07864 | 0.999 |
| 0.07865 | 0.999 |
| 0.07866 | 0.999 |
| 0.07867 | 0.999 |
| 0.07868 | 0.999 |
| 0.07869 | 0.999 |
| 0.0787 | 0.999 |
| 0.07871 | 0.999 |
| 0.07872 | 0.999 |
| 0.07873 | 0.999 |
| 0.07874 | 0.999 |
| 0.07875 | 0.999 |
| 0.07876 | 0.999 |
| 0.07877 | 0.999 |
| 0.07878 | 0.999 |
| 0.07879 | 0.999 |
| 0.0788 | 0.999 |
| 0.07881 | 0.999 |
| 0.07882 | 0.999 |
| 0.07883 | 0.999 |
| 0.07884 | 0.999 |
| 0.07885 | 0.999 |
| 0.07886 | 0.999 |
| 0.07887 | 0.999 |
| 0.07888 | 0.999 |
| 0.07889 | 0.999 |
| 0.0789 | 0.999 |
| 0.07891 | 0.999 |
| 0.07892 | 0.999 |
| 0.07893 | 0.999 |
| 0.07894 | 0.999 |
| 0.07895 | 0.999 |
| 0.07896 | 0.999 |
| 0.07897 | 0.999 |
| 0.07898 | 0.999 |
| 0.07899 | 0.999 |
| 0.079 | 0.999 |
| 0.07901 | 0.999 |
| 0.07902 | 0.999 |
| 0.07903 | 0.999 |
| 0.07904 | 0.999 |
| 0.07905 | 0.999 |
| 0.07906 | 0.999 |
| 0.07907 | 0.999 |
| 0.07908 | 0.999 |
| 0.07909 | 0.999 |
| 0.0791 | 0.999 |
| 0.07911 | 0.999 |
| 0.07912 | 0.999 |
| 0.07913 | 0.999 |
| 0.07914 | 0.999 |
| 0.07915 | 0.999 |
| 0.07916 | 0.999 |
| 0.07917 | 0.999 |
| 0.07918 | 0.999 |
| 0.07919 | 0.999 |
| 0.0792 | 0.999 |
| 0.07921 | 0.999 |
| 0.07922 | 0.999 |
| 0.07923 | 0.999 |
| 0.07924 | 0.999 |
| 0.07925 | 0.999 |
| 0.07926 | 0.999 |
| 0.07927 | 0.999 |
| 0.07928 | 0.999 |
| 0.07929 | 0.999 |
| 0.0793 | 0.999 |
| 0.07931 | 0.999 |
| 0.07932 | 1 |
| 0.07933 | 1 |
| 0.07934 | 1 |
| 0.07935 | 1 |
| 0.07936 | 1 |
| 0.07937 | 1 |
| 0.07938 | 1 |
| 0.07939 | 1 |
| 0.0794 | 1 |
| 0.07941 | 1 |
| 0.07942 | 1 |
| 0.07943 | 1 |
| 0.07944 | 1 |
| 0.07945 | 1 |
| 0.07946 | 1 |
| 0.07947 | 1 |
| 0.07948 | 1 |
| 0.07949 | 1 |
| 0.0795 | 1 |
| 0.07951 | 1 |
| 0.07952 | 1 |
| 0.07953 | 1 |
| 0.07954 | 1 |
| 0.07955 | 1 |
| 0.07956 | 1 |
| 0.07957 | 1 |
| 0.07958 | 1 |
| 0.07959 | 1 |
| 0.0796 | 1 |
| 0.07961 | 1 |
| 0.07962 | 1 |
| 0.07963 | 1 |
| 0.07964 | 1 |
| 0.07965 | 1 |
| 0.07966 | 1 |
| 0.07967 | 1 |
| 0.07968 | 1 |
| 0.07969 | 1 |
| 0.0797 | 1 |
| 0.07971 | 1 |
| 0.07972 | 1 |
| 0.07973 | 1 |
| 0.07974 | 1 |
| 0.07975 | 1 |
| 0.07976 | 1 |
| 0.07977 | 1 |
| 0.07978 | 1 |
| 0.07979 | 1 |
| 0.0798 | 1 |
| 0.07981 | 1 |
| 0.07982 | 1 |
| 0.07983 | 1 |
| 0.07984 | 1 |
| 0.07985 | 1 |
| 0.07986 | 1 |
| 0.07987 | 1 |
| 0.07988 | 1 |
| 0.07989 | 1 |
| 0.0799 | 1 |
| 0.07991 | 1 |
| 0.07992 | 1 |
| 0.07993 | 1 |
| 0.07994 | 1 |
| 0.07995 | 1 |
| 0.07996 | 1 |
| 0.07997 | 1 |
| 0.07998 | 1 |
| 0.07999 | 1 |
| 0.08 | 1 |
| 0.08001 | 1 |
| 0.08002 | 1 |
| 0.08003 | 1 |
| 0.08004 | 1 |
| 0.08005 | 1 |
| 0.08006 | 1 |
| 0.08007 | 1 |
| 0.08008 | 1 |
| 0.08009 | 1 |
| 0.0801 | 1 |
| 0.08011 | 1 |
| 0.08012 | 1 |
| 0.08013 | 1 |
| 0.08014 | 1 |
| 0.08015 | 1 |
| 0.08016 | 1 |
| 0.08017 | 1 |
| 0.08018 | 1 |
| 0.08019 | 1 |
| 0.0802 | 1 |
| 0.08021 | 1 |
| 0.08022 | 1 |
| 0.08023 | 1 |
| 0.08024 | 1 |
| 0.08025 | 1 |
| 0.08026 | 1 |
| 0.08027 | 1 |
| 0.08028 | 1 |
| 0.08029 | 1 |
| 0.0803 | 1 |
| 0.08031 | 1 |
| 0.08032 | 1 |
| 0.08033 | 1 |
| 0.08034 | 1 |
| 0.08035 | 1 |
| 0.08036 | 1 |
| 0.08037 | 1 |
| 0.08038 | 1 |
| 0.08039 | 1 |
| 0.0804 | 1 |
| 0.08041 | 1 |
| 0.08042 | 1 |
| 0.08043 | 1 |
| 0.08044 | 1 |
| 0.08045 | 1 |
| 0.08046 | 1 |
| 0.08047 | 1 |
| 0.08048 | 1 |
| 0.08049 | 1 |
| 0.0805 | 1 |
| 0.08051 | 1 |
| 0.08052 | 1 |
| 0.08053 | 1 |
| 0.08054 | 1 |
| 0.08055 | 1 |
| 0.08056 | 1 |
| 0.08057 | 1 |
| 0.08058 | 1 |
| 0.08059 | 1 |
| 0.0806 | 1 |
| 0.08061 | 1 |
| 0.08062 | 1 |
| 0.08063 | 1 |
| 0.08064 | 1 |
| 0.08065 | 1 |
| 0.08066 | 1 |
| 0.08067 | 1 |
| 0.08068 | 1 |
| 0.08069 | 1 |
| 0.0807 | 1 |
| 0.08071 | 1 |
| 0.08072 | 1 |
| 0.08073 | 1 |
| 0.08074 | 1 |
| 0.08075 | 1 |
| 0.08076 | 1 |
| 0.08077 | 1 |
| 0.08078 | 1 |
| 0.08079 | 1 |
| 0.0808 | 1 |
| 0.08081 | 1 |
| 0.08082 | 1 |
| 0.08083 | 1 |
| 0.08084 | 1 |
| 0.08085 | 1 |
| 0.08086 | 1 |
| 0.08087 | 1 |
| 0.08088 | 1 |
| 0.08089 | 1 |
| 0.0809 | 1 |
| 0.08091 | 1 |
| 0.08092 | 1 |
| 0.08093 | 1 |
| 0.08094 | 1 |
| 0.08095 | 1 |
| 0.08096 | 1 |
| 0.08097 | 1 |
| 0.08098 | 1 |
| 0.08099 | 1 |
| 0.081 | 1 |
| 0.08101 | 1 |
| 0.08102 | 1 |
| 0.08103 | 1 |
| 0.08104 | 1 |
| 0.08105 | 1 |
| 0.08106 | 1 |
| 0.08107 | 1 |
| 0.08108 | 1 |
| 0.08109 | 1 |
| 0.0811 | 1 |
| 0.08111 | 1 |
| 0.08112 | 1 |
| 0.08113 | 1 |
| 0.08114 | 1 |
| 0.08115 | 1 |
| 0.08116 | 1 |
| 0.08117 | 1 |
| 0.08118 | 1 |
| 0.08119 | 1 |
| 0.0812 | 1 |
| 0.08121 | 1 |
| 0.08122 | 1 |
| 0.08123 | 1 |
| 0.08124 | 1 |
| 0.08125 | 1 |
| 0.08126 | 1 |
| 0.08127 | 1 |
| 0.08128 | 1 |
| 0.08129 | 1 |
| 0.0813 | 1 |
| 0.08131 | 1 |
| 0.08132 | 1 |
| 0.08133 | 1 |
| 0.08134 | 1 |
| 0.08135 | 1 |
| 0.08136 | 1 |
| 0.08137 | 1 |
| 0.08138 | 1 |
| 0.08139 | 1 |
| 0.0814 | 1 |
| 0.08141 | 1 |
| 0.08142 | 1 |
| 0.08143 | 1 |
| 0.08144 | 1 |
| 0.08145 | 1 |
| 0.08146 | 1 |
| 0.08147 | 1 |
| 0.08148 | 1 |
| 0.08149 | 1 |
| 0.0815 | 1 |
| 0.08151 | 1 |
| 0.08152 | 1 |
| 0.08153 | 1 |
| 0.08154 | 1 |
| 0.08155 | 1 |
| 0.08156 | 1 |
| 0.08157 | 1 |
| 0.08158 | 1 |
| 0.08159 | 1 |
| 0.0816 | 1 |
| 0.08161 | 1 |
| 0.08162 | 1 |
| 0.08163 | 1 |
| 0.08164 | 1 |
| 0.08165 | 1 |
| 0.08166 | 1 |
| 0.08167 | 1 |
| 0.08168 | 1 |
| 0.08169 | 1 |
| 0.0817 | 1 |
| 0.08171 | 1 |
| 0.08172 | 1 |
| 0.08173 | 1 |
| 0.08174 | 1 |
| 0.08175 | 1 |
| 0.08176 | 1 |
| 0.08177 | 1 |
| 0.08178 | 1 |
| 0.08179 | 1 |
| 0.0818 | 1 |
| 0.08181 | 1 |
| 0.08182 | 1 |
| 0.08183 | 1 |
| 0.08184 | 1 |
| 0.08185 | 1 |
| 0.08186 | 1 |
| 0.08187 | 1 |
| 0.08188 | 1 |
| 0.08189 | 1 |
| 0.0819 | 1 |
| 0.08191 | 1 |
| 0.08192 | 1 |
| 0.08193 | 1 |
| 0.08194 | 1 |
| 0.08195 | 1 |
| 0.08196 | 1 |
| 0.08197 | 1 |
| 0.08198 | 1 |
| 0.08199 | 1 |
| 0.082 | 1 |
| 0.08201 | 1 |
| 0.08202 | 1 |
| 0.08203 | 1 |
| 0.08204 | 1 |
| 0.08205 | 1 |
| 0.08206 | 1 |
| 0.08207 | 1 |
| 0.08208 | 1 |
| 0.08209 | 1 |
| 0.0821 | 1 |
| 0.08211 | 1 |
| 0.08212 | 1 |
| 0.08213 | 1 |
| 0.08214 | 1 |
| 0.08215 | 1 |
| 0.08216 | 1 |
| 0.08217 | 1 |
| 0.08218 | 1 |
| 0.08219 | 1 |
| 0.0822 | 1 |
| 0.08221 | 1 |
| 0.08222 | 1 |
| 0.08223 | 1 |
| 0.08224 | 1 |
| 0.08225 | 1 |
| 0.08226 | 1 |
| 0.08227 | 1 |
| 0.08228 | 1 |
| 0.08229 | 1 |
| 0.0823 | 1 |
| 0.08231 | 1 |
| 0.08232 | 1 |
| 0.08233 | 1 |
| 0.08234 | 1 |
| 0.08235 | 1 |
| 0.08236 | 1 |
| 0.08237 | 1 |
| 0.08238 | 1 |
| 0.08239 | 1 |
| 0.0824 | 1 |
| 0.08241 | 1 |
| 0.08242 | 1 |
| 0.08243 | 1 |
| 0.08244 | 1 |
| 0.08245 | 1 |
| 0.08246 | 1 |
| 0.08247 | 1 |
| 0.08248 | 1 |
| 0.08249 | 1 |
| 0.0825 | 1 |
| 0.08251 | 1 |
| 0.08252 | 1 |
| 0.08253 | 1 |
| 0.08254 | 1 |
| 0.08255 | 1 |
| 0.08256 | 1 |
| 0.08257 | 1 |
| 0.08258 | 1 |
| 0.08259 | 1 |
| 0.0826 | 1 |
| 0.08261 | 1 |
| 0.08262 | 1 |
| 0.08263 | 1 |
| 0.08264 | 1 |
| 0.08265 | 1 |
| 0.08266 | 1 |
| 0.08267 | 1 |
| 0.08268 | 1 |
| 0.08269 | 1 |
| 0.0827 | 1 |
| 0.08271 | 1 |
| 0.08272 | 1 |
| 0.08273 | 1 |
| 0.08274 | 1 |
| 0.08275 | 1 |
| 0.08276 | 1 |
| 0.08277 | 1 |
| 0.08278 | 1 |
| 0.08279 | 1 |
| 0.0828 | 1 |
| 0.08281 | 1 |
| 0.08282 | 1 |
| 0.08283 | 1 |
| 0.08284 | 1 |
| 0.08285 | 1 |
| 0.08286 | 1 |
| 0.08287 | 1 |
| 0.08288 | 1 |
| 0.08289 | 1 |
| 0.0829 | 1 |
| 0.08291 | 1 |
| 0.08292 | 1 |
| 0.08293 | 1 |
| 0.08294 | 1 |
| 0.08295 | 1 |
| 0.08296 | 1 |
| 0.08297 | 1 |
| 0.08298 | 1 |
| 0.08299 | 1 |
| 0.083 | 1 |
| 0.08301 | 1 |
| 0.08302 | 1 |
| 0.08303 | 1 |
| 0.08304 | 1 |
| 0.08305 | 1 |
| 0.08306 | 1 |
| 0.08307 | 1 |
| 0.08308 | 1 |
| 0.08309 | 1 |
| 0.0831 | 1 |
| 0.08311 | 1 |
| 0.08312 | 1 |
| 0.08313 | 1 |
| 0.08314 | 1 |
| 0.08315 | 1 |
| 0.08316 | 1 |
| 0.08317 | 1 |
| 0.08318 | 1 |
| 0.08319 | 1 |
| 0.0832 | 1 |
| 0.08321 | 1 |
| 0.08322 | 1 |
| 0.08323 | 1 |
| 0.08324 | 1 |
| 0.08325 | 1 |
| 0.08326 | 1 |
| 0.08327 | 1 |
| 0.08328 | 1 |
| 0.08329 | 1 |
| 0.0833 | 1 |
| 0.08331 | 1 |
| 0.08332 | 1 |
| 0.08333 | 1 |
| 0.08334 | 1 |
| 0.08335 | 1 |
| 0.08336 | 1 |
| 0.08337 | 1 |
| 0.08338 | 1 |
| 0.08339 | 1 |
| 0.0834 | 1 |
| 0.08341 | 1 |
| 0.08342 | 1 |
| 0.08343 | 1 |
| 0.08344 | 1 |
| 0.08345 | 1 |
| 0.08346 | 1 |
| 0.08347 | 1 |
| 0.08348 | 1 |
| 0.08349 | 1 |
| 0.0835 | 1 |
| 0.08351 | 1 |
| 0.08352 | 1 |
| 0.08353 | 1 |
| 0.08354 | 1 |
| 0.08355 | 1 |
| 0.08356 | 1 |
| 0.08357 | 1 |
| 0.08358 | 1 |
| 0.08359 | 1 |
| 0.0836 | 1 |
| 0.08361 | 1 |
| 0.08362 | 1 |
| 0.08363 | 1 |
| 0.08364 | 1 |
| 0.08365 | 1 |
| 0.08366 | 1 |
| 0.08367 | 1 |
| 0.08368 | 1 |
| 0.08369 | 1 |
| 0.0837 | 1 |
| 0.08371 | 1 |
| 0.08372 | 1 |
| 0.08373 | 1 |
| 0.08374 | 1 |
| 0.08375 | 1 |
| 0.08376 | 1 |
| 0.08377 | 1 |
| 0.08378 | 1 |
| 0.08379 | 1 |
| 0.0838 | 1 |
| 0.08381 | 1 |
| 0.08382 | 1 |
| 0.08383 | 1 |
| 0.08384 | 1 |
| 0.08385 | 1 |
| 0.08386 | 1 |
| 0.08387 | 1 |
| 0.08388 | 1 |
| 0.08389 | 1 |
| 0.0839 | 1 |
| 0.08391 | 1 |
| 0.08392 | 1 |
| 0.08393 | 1 |
| 0.08394 | 1 |
| 0.08395 | 1 |
| 0.08396 | 1 |
| 0.08397 | 1 |
| 0.08398 | 1 |
| 0.08399 | 1 |
| 0.084 | 1 |
| 0.08401 | 1 |
| 0.08402 | 1 |
| 0.08403 | 1 |
| 0.08404 | 1 |
| 0.08405 | 1 |
| 0.08406 | 1 |
| 0.08407 | 1 |
| 0.08408 | 1 |
| 0.08409 | 1 |
| 0.0841 | 1 |
| 0.08411 | 1 |
| 0.08412 | 1 |
| 0.08413 | 1 |
| 0.08414 | 1 |
| 0.08415 | 1 |
| 0.08416 | 1 |
| 0.08417 | 1 |
| 0.08418 | 1 |
| 0.08419 | 1 |
| 0.0842 | 1 |
| 0.08421 | 1 |
| 0.08422 | 1 |
| 0.08423 | 1 |
| 0.08424 | 1 |
| 0.08425 | 1 |
| 0.08426 | 1 |
| 0.08427 | 1 |
| 0.08428 | 1 |
| 0.08429 | 1 |
| 0.0843 | 1 |
| 0.08431 | 1 |
| 0.08432 | 1 |
| 0.08433 | 1 |
| 0.08434 | 1 |
| 0.08435 | 1 |
| 0.08436 | 1 |
| 0.08437 | 1 |
| 0.08438 | 1 |
| 0.08439 | 1 |
| 0.0844 | 1 |
| 0.08441 | 1 |
| 0.08442 | 1 |
| 0.08443 | 1 |
| 0.08444 | 1 |
| 0.08445 | 1 |
| 0.08446 | 1 |
| 0.08447 | 1 |
| 0.08448 | 1 |
| 0.08449 | 1 |
| 0.0845 | 1 |
| 0.08451 | 1 |
| 0.08452 | 1 |
| 0.08453 | 1 |
| 0.08454 | 1 |
| 0.08455 | 1 |
| 0.08456 | 1 |
| 0.08457 | 1 |
| 0.08458 | 1 |
| 0.08459 | 1 |
| 0.0846 | 1 |
| 0.08461 | 1 |
| 0.08462 | 1 |
| 0.08463 | 1 |
| 0.08464 | 1 |
| 0.08465 | 1 |
| 0.08466 | 1 |
| 0.08467 | 1 |
| 0.08468 | 1 |
| 0.08469 | 1 |
| 0.0847 | 1 |
| 0.08471 | 1 |
| 0.08472 | 1 |
| 0.08473 | 1 |
| 0.08474 | 1 |
| 0.08475 | 1 |
| 0.08476 | 1 |
| 0.08477 | 1 |
| 0.08478 | 1 |
| 0.08479 | 1 |
| 0.0848 | 1 |
| 0.08481 | 1 |
| 0.08482 | 1 |
| 0.08483 | 1 |
| 0.08484 | 1 |
| 0.08485 | 1 |
| 0.08486 | 1 |
| 0.08487 | 1 |
| 0.08488 | 1 |
| 0.08489 | 1 |
| 0.0849 | 1 |
| 0.08491 | 1 |
| 0.08492 | 1 |
| 0.08493 | 1 |
| 0.08494 | 1 |
| 0.08495 | 1 |
| 0.08496 | 1 |
| 0.08497 | 1 |
| 0.08498 | 1 |
| 0.08499 | 1 |
| 0.085 | 1 |
| 0.08501 | 1 |
| 0.08502 | 1 |
| 0.08503 | 1 |
| 0.08504 | 1 |
| 0.08505 | 1 |
| 0.08506 | 1 |
| 0.08507 | 1 |
| 0.08508 | 1 |
| 0.08509 | 1 |
| 0.0851 | 1 |
| 0.08511 | 1 |
| 0.08512 | 1 |
| 0.08513 | 1 |
| 0.08514 | 1 |
| 0.08515 | 1 |
| 0.08516 | 1 |
| 0.08517 | 1 |
| 0.08518 | 1 |
| 0.08519 | 1 |
| 0.0852 | 1 |
| 0.08521 | 1 |
| 0.08522 | 1 |
| 0.08523 | 1 |
| 0.08524 | 1 |
| 0.08525 | 1 |
| 0.08526 | 1 |
| 0.08527 | 1 |
| 0.08528 | 1 |
| 0.08529 | 1 |
| 0.0853 | 1 |
| 0.08531 | 1 |
| 0.08532 | 1 |
| 0.08533 | 1 |
| 0.08534 | 1 |
| 0.08535 | 1 |
| 0.08536 | 1 |
| 0.08537 | 1 |
| 0.08538 | 1 |
| 0.08539 | 1 |
| 0.0854 | 1 |
| 0.08541 | 1 |
| 0.08542 | 1 |
| 0.08543 | 1 |
| 0.08544 | 1 |
| 0.08545 | 1 |
| 0.08546 | 1 |
| 0.08547 | 1 |
| 0.08548 | 1 |
| 0.08549 | 1 |
| 0.0855 | 1 |
| 0.08551 | 1 |
| 0.08552 | 1 |
| 0.08553 | 1 |
| 0.08554 | 1 |
| 0.08555 | 1 |
| 0.08556 | 1 |
| 0.08557 | 1 |
| 0.08558 | 1 |
| 0.08559 | 1 |
| 0.0856 | 1 |
| 0.08561 | 1 |
| 0.08562 | 1 |
| 0.08563 | 1 |
| 0.08564 | 1 |
| 0.08565 | 1 |
| 0.08566 | 1 |
| 0.08567 | 1 |
| 0.08568 | 1 |
| 0.08569 | 1 |
| 0.0857 | 1 |
| 0.08571 | 1 |
| 0.08572 | 1 |
| 0.08573 | 1 |
| 0.08574 | 1 |
| 0.08575 | 1 |
| 0.08576 | 1 |
| 0.08577 | 1 |
| 0.08578 | 1 |
| 0.08579 | 1 |
| 0.0858 | 1 |
| 0.08581 | 1 |
| 0.08582 | 1 |
| 0.08583 | 1 |
| 0.08584 | 1 |
| 0.08585 | 1 |
| 0.08586 | 1 |
| 0.08587 | 1 |
| 0.08588 | 1 |
| 0.08589 | 1 |
| 0.0859 | 1 |
| 0.08591 | 1 |
| 0.08592 | 1 |
| 0.08593 | 1 |
| 0.08594 | 1 |
| 0.08595 | 1 |
| 0.08596 | 1 |
| 0.08597 | 1 |
| 0.08598 | 1 |
| 0.08599 | 1 |
| 0.086 | 1 |
| 0.08601 | 1 |
| 0.08602 | 1 |
| 0.08603 | 1 |
| 0.08604 | 1 |
| 0.08605 | 1 |
| 0.08606 | 1 |
| 0.08607 | 1 |
| 0.08608 | 1 |
| 0.08609 | 1 |
| 0.0861 | 1 |
| 0.08611 | 1 |
| 0.08612 | 1 |
| 0.08613 | 1 |
| 0.08614 | 1 |
| 0.08615 | 1 |
| 0.08616 | 1 |
| 0.08617 | 1 |
| 0.08618 | 1 |
| 0.08619 | 1 |
| 0.0862 | 1 |
| 0.08621 | 1 |
| 0.08622 | 1 |
| 0.08623 | 1 |
| 0.08624 | 1 |
| 0.08625 | 1 |
| 0.08626 | 1 |
| 0.08627 | 1 |
| 0.08628 | 1 |
| 0.08629 | 1 |
| 0.0863 | 1 |
| 0.08631 | 1 |
| 0.08632 | 1 |
| 0.08633 | 1 |
| 0.08634 | 1 |
| 0.08635 | 1 |
| 0.08636 | 1 |
| 0.08637 | 1 |
| 0.08638 | 1 |
| 0.08639 | 1 |
| 0.0864 | 1 |
| 0.08641 | 1 |
| 0.08642 | 1 |
| 0.08643 | 1 |
| 0.08644 | 1 |
| 0.08645 | 1 |
| 0.08646 | 1 |
| 0.08647 | 1 |
| 0.08648 | 1 |
| 0.08649 | 1 |
| 0.0865 | 1 |
| 0.08651 | 1 |
| 0.08652 | 1 |
| 0.08653 | 1 |
| 0.08654 | 1 |
| 0.08655 | 1 |
| 0.08656 | 1 |
| 0.08657 | 1 |
| 0.08658 | 1 |
| 0.08659 | 1 |
| 0.0866 | 1 |
| 0.08661 | 1 |
| 0.08662 | 1 |
| 0.08663 | 1 |
| 0.08664 | 1 |
| 0.08665 | 1 |
| 0.08666 | 1 |
| 0.08667 | 1 |
| 0.08668 | 1 |
| 0.08669 | 1 |
| 0.0867 | 1 |
| 0.08671 | 1 |
| 0.08672 | 1 |
| 0.08673 | 1 |
| 0.08674 | 1 |
| 0.08675 | 1 |
| 0.08676 | 1 |
| 0.08677 | 1 |
| 0.08678 | 1 |
| 0.08679 | 1 |
| 0.0868 | 1 |
| 0.08681 | 1 |
| 0.08682 | 1 |
| 0.08683 | 1 |
| 0.08684 | 1 |
| 0.08685 | 1 |
| 0.08686 | 1 |
| 0.08687 | 1 |
| 0.08688 | 1 |
| 0.08689 | 1 |
| 0.0869 | 1 |
| 0.08691 | 1 |
| 0.08692 | 1 |
| 0.08693 | 1 |
| 0.08694 | 1 |
| 0.08695 | 1 |
| 0.08696 | 1 |
| 0.08697 | 1 |
| 0.08698 | 1 |
| 0.08699 | 1 |
| 0.087 | 1 |
| 0.08701 | 1 |
| 0.08702 | 1 |
| 0.08703 | 1 |
| 0.08704 | 1 |
| 0.08705 | 1 |
| 0.08706 | 1 |
| 0.08707 | 1 |
| 0.08708 | 1 |
| 0.08709 | 1 |
| 0.0871 | 1 |
| 0.08711 | 1 |
| 0.08712 | 1 |
| 0.08713 | 1 |
| 0.08714 | 1 |
| 0.08715 | 1 |
| 0.08716 | 1 |
| 0.08717 | 1 |
| 0.08718 | 1 |
| 0.08719 | 1 |
| 0.0872 | 1 |
| 0.08721 | 1 |
| 0.08722 | 1 |
| 0.08723 | 1 |
| 0.08724 | 1 |
| 0.08725 | 1 |
| 0.08726 | 1 |
| 0.08727 | 1 |
| 0.08728 | 1 |
| 0.08729 | 1 |
| 0.0873 | 1 |
| 0.08731 | 1 |
| 0.08732 | 1 |
| 0.08733 | 1 |
| 0.08734 | 1 |
| 0.08735 | 1 |
| 0.08736 | 1 |
| 0.08737 | 1 |
| 0.08738 | 1 |
| 0.08739 | 1 |
| 0.0874 | 1 |
| 0.08741 | 1 |
| 0.08742 | 1 |
| 0.08743 | 1 |
| 0.08744 | 1 |
| 0.08745 | 1 |
| 0.08746 | 1 |
| 0.08747 | 1 |
| 0.08748 | 1 |
| 0.08749 | 1 |
| 0.0875 | 1 |
| 0.08751 | 1 |
| 0.08752 | 1 |
| 0.08753 | 1 |
| 0.08754 | 1 |
| 0.08755 | 1 |
| 0.08756 | 1 |
| 0.08757 | 1 |
| 0.08758 | 1 |
| 0.08759 | 1 |
| 0.0876 | 1 |
| 0.08761 | 1 |
| 0.08762 | 1 |
| 0.08763 | 1 |
| 0.08764 | 1 |
| 0.08765 | 1 |
| 0.08766 | 1 |
| 0.08767 | 1 |
| 0.08768 | 1 |
| 0.08769 | 1 |
| 0.0877 | 1 |
| 0.08771 | 1 |
| 0.08772 | 1 |
| 0.08773 | 1 |
| 0.08774 | 1 |
| 0.08775 | 1 |
| 0.08776 | 1 |
| 0.08777 | 1 |
| 0.08778 | 1 |
| 0.08779 | 1 |
| 0.0878 | 1 |
| 0.08781 | 1 |
| 0.08782 | 1 |
| 0.08783 | 1 |
| 0.08784 | 1 |
| 0.08785 | 1 |
| 0.08786 | 1 |
| 0.08787 | 1 |
| 0.08788 | 1 |
| 0.08789 | 1 |
| 0.0879 | 1 |
| 0.08791 | 1 |
| 0.08792 | 1 |
| 0.08793 | 1 |
| 0.08794 | 1 |
| 0.08795 | 1 |
| 0.08796 | 1 |
| 0.08797 | 1 |
| 0.08798 | 1 |
| 0.08799 | 1 |
| 0.088 | 1 |
| 0.08801 | 1 |
| 0.08802 | 1 |
| 0.08803 | 1 |
| 0.08804 | 1 |
| 0.08805 | 1 |
| 0.08806 | 0.999 |
| 0.08807 | 0.999 |
| 0.08808 | 0.999 |
| 0.08809 | 0.999 |
| 0.0881 | 0.999 |
| 0.08811 | 0.999 |
| 0.08812 | 0.999 |
| 0.08813 | 0.999 |
| 0.08814 | 0.999 |
| 0.08815 | 0.999 |
| 0.08816 | 0.999 |
| 0.08817 | 0.999 |
| 0.08818 | 0.999 |
| 0.08819 | 0.999 |
| 0.0882 | 0.999 |
| 0.08821 | 0.999 |
| 0.08822 | 0.999 |
| 0.08823 | 0.999 |
| 0.08824 | 0.999 |
| 0.08825 | 0.999 |
| 0.08826 | 0.999 |
| 0.08827 | 0.999 |
| 0.08828 | 0.999 |
| 0.08829 | 0.999 |
| 0.0883 | 0.999 |
| 0.08831 | 0.999 |
| 0.08832 | 0.999 |
| 0.08833 | 0.999 |
| 0.08834 | 0.999 |
| 0.08835 | 0.999 |
| 0.08836 | 0.999 |
| 0.08837 | 0.999 |
| 0.08838 | 0.999 |
| 0.08839 | 0.999 |
| 0.0884 | 0.999 |
| 0.08841 | 0.999 |
| 0.08842 | 0.999 |
| 0.08843 | 0.999 |
| 0.08844 | 0.999 |
| 0.08845 | 0.999 |
| 0.08846 | 0.999 |
| 0.08847 | 0.999 |
| 0.08848 | 0.999 |
| 0.08849 | 0.999 |
| 0.0885 | 0.999 |
| 0.08851 | 0.999 |
| 0.08852 | 0.999 |
| 0.08853 | 0.999 |
| 0.08854 | 0.999 |
| 0.08855 | 0.999 |
| 0.08856 | 0.999 |
| 0.08857 | 0.999 |
| 0.08858 | 0.999 |
| 0.08859 | 0.999 |
| 0.0886 | 0.999 |
| 0.08861 | 0.999 |
| 0.08862 | 0.999 |
| 0.08863 | 0.999 |
| 0.08864 | 0.999 |
| 0.08865 | 0.999 |
| 0.08866 | 0.999 |
| 0.08867 | 0.999 |
| 0.08868 | 0.999 |
| 0.08869 | 0.999 |
| 0.0887 | 0.999 |
| 0.08871 | 0.999 |
| 0.08872 | 0.999 |
| 0.08873 | 0.999 |
| 0.08874 | 0.999 |
| 0.08875 | 0.999 |
| 0.08876 | 0.999 |
| 0.08877 | 0.999 |
| 0.08878 | 0.999 |
| 0.08879 | 0.999 |
| 0.0888 | 0.999 |
| 0.08881 | 0.999 |
| 0.08882 | 0.999 |
| 0.08883 | 0.999 |
| 0.08884 | 0.999 |
| 0.08885 | 0.999 |
| 0.08886 | 0.999 |
| 0.08887 | 0.999 |
| 0.08888 | 0.999 |
| 0.08889 | 0.999 |
| 0.0889 | 0.999 |
| 0.08891 | 0.999 |
| 0.08892 | 0.999 |
| 0.08893 | 0.999 |
| 0.08894 | 0.999 |
| 0.08895 | 0.999 |
| 0.08896 | 0.999 |
| 0.08897 | 0.999 |
| 0.08898 | 0.999 |
| 0.08899 | 0.999 |
| 0.089 | 0.999 |
| 0.08901 | 0.999 |
| 0.08902 | 0.999 |
| 0.08903 | 0.999 |
| 0.08904 | 0.999 |
| 0.08905 | 0.999 |
| 0.08906 | 0.999 |
| 0.08907 | 0.999 |
| 0.08908 | 0.999 |
| 0.08909 | 0.999 |
| 0.0891 | 0.999 |
| 0.08911 | 0.999 |
| 0.08912 | 0.999 |
| 0.08913 | 0.999 |
| 0.08914 | 0.999 |
| 0.08915 | 0.999 |
| 0.08916 | 0.999 |
| 0.08917 | 0.999 |
| 0.08918 | 0.999 |
| 0.08919 | 0.999 |
| 0.0892 | 0.999 |
| 0.08921 | 0.999 |
| 0.08922 | 0.999 |
| 0.08923 | 0.999 |
| 0.08924 | 0.999 |
| 0.08925 | 0.999 |
| 0.08926 | 0.999 |
| 0.08927 | 0.999 |
| 0.08928 | 0.999 |
| 0.08929 | 0.999 |
| 0.0893 | 0.999 |
| 0.08931 | 0.999 |
| 0.08932 | 0.999 |
| 0.08933 | 0.999 |
| 0.08934 | 0.999 |
| 0.08935 | 0.999 |
| 0.08936 | 0.999 |
| 0.08937 | 0.999 |
| 0.08938 | 0.999 |
| 0.08939 | 0.999 |
| 0.0894 | 0.999 |
| 0.08941 | 0.999 |
| 0.08942 | 0.999 |
| 0.08943 | 0.999 |
| 0.08944 | 0.999 |
| 0.08945 | 0.999 |
| 0.08946 | 0.999 |
| 0.08947 | 0.999 |
| 0.08948 | 0.999 |
| 0.08949 | 0.999 |
| 0.0895 | 0.999 |
| 0.08951 | 0.999 |
| 0.08952 | 0.999 |
| 0.08953 | 0.999 |
| 0.08954 | 0.999 |
| 0.08955 | 0.999 |
| 0.08956 | 0.999 |
| 0.08957 | 0.999 |
| 0.08958 | 0.999 |
| 0.08959 | 0.999 |
| 0.0896 | 0.999 |
| 0.08961 | 0.999 |
| 0.08962 | 0.999 |
| 0.08963 | 0.999 |
| 0.08964 | 0.999 |
| 0.08965 | 0.999 |
| 0.08966 | 0.999 |
| 0.08967 | 0.999 |
| 0.08968 | 0.999 |
| 0.08969 | 0.999 |
| 0.0897 | 0.999 |
| 0.08971 | 0.999 |
| 0.08972 | 0.999 |
| 0.08973 | 0.999 |
| 0.08974 | 0.999 |
| 0.08975 | 0.999 |
| 0.08976 | 0.999 |
| 0.08977 | 0.999 |
| 0.08978 | 0.999 |
| 0.08979 | 0.999 |
| 0.0898 | 0.999 |
| 0.08981 | 0.999 |
| 0.08982 | 0.999 |
| 0.08983 | 0.999 |
| 0.08984 | 0.999 |
| 0.08985 | 0.999 |
| 0.08986 | 0.999 |
| 0.08987 | 0.999 |
| 0.08988 | 0.999 |
| 0.08989 | 0.999 |
| 0.0899 | 0.999 |
| 0.08991 | 0.999 |
| 0.08992 | 0.999 |
| 0.08993 | 0.999 |
| 0.08994 | 0.999 |
| 0.08995 | 0.999 |
| 0.08996 | 0.999 |
| 0.08997 | 0.999 |
| 0.08998 | 0.999 |
| 0.08999 | 0.999 |
| 0.09 | 0.999 |
| 0.09001 | 0.999 |
| 0.09002 | 0.999 |
| 0.09003 | 0.999 |
| 0.09004 | 0.999 |
| 0.09005 | 0.999 |
| 0.09006 | 0.999 |
| 0.09007 | 0.999 |
| 0.09008 | 0.999 |
| 0.09009 | 0.999 |
| 0.0901 | 0.999 |
| 0.09011 | 0.999 |
| 0.09012 | 0.999 |
| 0.09013 | 0.999 |
| 0.09014 | 0.999 |
| 0.09015 | 0.999 |
| 0.09016 | 0.999 |
| 0.09017 | 0.999 |
| 0.09018 | 0.999 |
| 0.09019 | 0.999 |
| 0.0902 | 0.999 |
| 0.09021 | 0.999 |
| 0.09022 | 0.999 |
| 0.09023 | 0.999 |
| 0.09024 | 0.999 |
| 0.09025 | 0.999 |
| 0.09026 | 0.999 |
| 0.09027 | 0.999 |
| 0.09028 | 0.999 |
| 0.09029 | 0.999 |
| 0.0903 | 0.999 |
| 0.09031 | 0.999 |
| 0.09032 | 0.999 |
| 0.09033 | 0.999 |
| 0.09034 | 0.999 |
| 0.09035 | 0.999 |
| 0.09036 | 0.999 |
| 0.09037 | 0.999 |
| 0.09038 | 0.999 |
| 0.09039 | 0.999 |
| 0.0904 | 0.999 |
| 0.09041 | 0.999 |
| 0.09042 | 0.999 |
| 0.09043 | 0.999 |
| 0.09044 | 0.999 |
| 0.09045 | 0.999 |
| 0.09046 | 0.999 |
| 0.09047 | 0.999 |
| 0.09048 | 0.999 |
| 0.09049 | 0.999 |
| 0.0905 | 0.999 |
| 0.09051 | 0.999 |
| 0.09052 | 0.999 |
| 0.09053 | 0.999 |
| 0.09054 | 0.999 |
| 0.09055 | 0.999 |
| 0.09056 | 0.999 |
| 0.09057 | 0.999 |
| 0.09058 | 0.999 |
| 0.09059 | 0.999 |
| 0.0906 | 0.999 |
| 0.09061 | 0.999 |
| 0.09062 | 0.999 |
| 0.09063 | 0.999 |
| 0.09064 | 0.999 |
| 0.09065 | 0.999 |
| 0.09066 | 0.999 |
| 0.09067 | 0.999 |
| 0.09068 | 0.999 |
| 0.09069 | 0.999 |
| 0.0907 | 0.999 |
| 0.09071 | 0.999 |
| 0.09072 | 0.999 |
| 0.09073 | 0.999 |
| 0.09074 | 0.999 |
| 0.09075 | 0.999 |
| 0.09076 | 0.999 |
| 0.09077 | 0.999 |
| 0.09078 | 0.999 |
| 0.09079 | 0.999 |
| 0.0908 | 0.999 |
| 0.09081 | 0.999 |
| 0.09082 | 0.999 |
| 0.09083 | 0.999 |
| 0.09084 | 0.999 |
| 0.09085 | 0.999 |
| 0.09086 | 0.999 |
| 0.09087 | 0.999 |
| 0.09088 | 0.999 |
| 0.09089 | 0.999 |
| 0.0909 | 0.999 |
| 0.09091 | 0.999 |
| 0.09092 | 0.999 |
| 0.09093 | 0.999 |
| 0.09094 | 0.999 |
| 0.09095 | 0.999 |
| 0.09096 | 0.999 |
| 0.09097 | 0.999 |
| 0.09098 | 0.999 |
| 0.09099 | 0.999 |
| 0.091 | 0.999 |
| 0.09101 | 0.999 |
| 0.09102 | 0.999 |
| 0.09103 | 0.999 |
| 0.09104 | 0.999 |
| 0.09105 | 0.999 |
| 0.09106 | 0.999 |
| 0.09107 | 0.999 |
| 0.09108 | 0.999 |
| 0.09109 | 0.999 |
| 0.0911 | 0.999 |
| 0.09111 | 0.999 |
| 0.09112 | 0.999 |
| 0.09113 | 0.999 |
| 0.09114 | 0.999 |
| 0.09115 | 0.999 |
| 0.09116 | 0.999 |
| 0.09117 | 0.999 |
| 0.09118 | 0.999 |
| 0.09119 | 0.999 |
| 0.0912 | 0.999 |
| 0.09121 | 0.999 |
| 0.09122 | 0.999 |
| 0.09123 | 0.999 |
| 0.09124 | 0.999 |
| 0.09125 | 0.999 |
| 0.09126 | 0.999 |
| 0.09127 | 0.999 |
| 0.09128 | 0.999 |
| 0.09129 | 0.999 |
| 0.0913 | 0.999 |
| 0.09131 | 0.999 |
| 0.09132 | 0.999 |
| 0.09133 | 0.999 |
| 0.09134 | 0.999 |
| 0.09135 | 0.999 |
| 0.09136 | 0.999 |
| 0.09137 | 0.999 |
| 0.09138 | 0.999 |
| 0.09139 | 0.999 |
| 0.0914 | 0.999 |
| 0.09141 | 0.999 |
| 0.09142 | 0.999 |
| 0.09143 | 0.999 |
| 0.09144 | 0.999 |
| 0.09145 | 0.999 |
| 0.09146 | 0.999 |
| 0.09147 | 0.999 |
| 0.09148 | 0.999 |
| 0.09149 | 0.999 |
| 0.0915 | 0.999 |
| 0.09151 | 0.999 |
| 0.09152 | 0.999 |
| 0.09153 | 0.999 |
| 0.09154 | 0.999 |
| 0.09155 | 0.999 |
| 0.09156 | 0.999 |
| 0.09157 | 0.999 |
| 0.09158 | 0.999 |
| 0.09159 | 0.999 |
| 0.0916 | 0.999 |
| 0.09161 | 0.999 |
| 0.09162 | 0.999 |
| 0.09163 | 0.999 |
| 0.09164 | 0.999 |
| 0.09165 | 0.999 |
| 0.09166 | 0.999 |
| 0.09167 | 0.999 |
| 0.09168 | 0.999 |
| 0.09169 | 0.999 |
| 0.0917 | 0.999 |
| 0.09171 | 0.999 |
| 0.09172 | 0.999 |
| 0.09173 | 0.999 |
| 0.09174 | 0.999 |
| 0.09175 | 0.999 |
| 0.09176 | 0.999 |
| 0.09177 | 0.999 |
| 0.09178 | 0.999 |
| 0.09179 | 0.999 |
| 0.0918 | 0.999 |
| 0.09181 | 0.999 |
| 0.09182 | 0.999 |
| 0.09183 | 0.999 |
| 0.09184 | 0.999 |
| 0.09185 | 0.999 |
| 0.09186 | 0.999 |
| 0.09187 | 0.999 |
| 0.09188 | 0.999 |
| 0.09189 | 0.999 |
| 0.0919 | 0.999 |
| 0.09191 | 0.999 |
| 0.09192 | 0.999 |
| 0.09193 | 0.999 |
| 0.09194 | 0.999 |
| 0.09195 | 0.999 |
| 0.09196 | 0.999 |
| 0.09197 | 0.999 |
| 0.09198 | 0.999 |
| 0.09199 | 0.999 |
| 0.092 | 0.999 |
| 0.09201 | 0.999 |
| 0.09202 | 0.999 |
| 0.09203 | 0.999 |
| 0.09204 | 0.999 |
| 0.09205 | 0.999 |
| 0.09206 | 0.999 |
| 0.09207 | 0.999 |
| 0.09208 | 0.999 |
| 0.09209 | 0.999 |
| 0.0921 | 0.999 |
| 0.09211 | 0.999 |
| 0.09212 | 0.999 |
| 0.09213 | 0.999 |
| 0.09214 | 0.999 |
| 0.09215 | 0.999 |
| 0.09216 | 0.999 |
| 0.09217 | 0.999 |
| 0.09218 | 0.999 |
| 0.09219 | 0.999 |
| 0.0922 | 0.999 |
| 0.09221 | 0.999 |
| 0.09222 | 0.999 |
| 0.09223 | 0.999 |
| 0.09224 | 0.999 |
| 0.09225 | 0.999 |
| 0.09226 | 0.999 |
| 0.09227 | 0.999 |
| 0.09228 | 0.999 |
| 0.09229 | 0.999 |
| 0.0923 | 0.999 |
| 0.09231 | 0.999 |
| 0.09232 | 0.999 |
| 0.09233 | 0.999 |
| 0.09234 | 0.999 |
| 0.09235 | 0.999 |
| 0.09236 | 0.999 |
| 0.09237 | 0.999 |
| 0.09238 | 0.999 |
| 0.09239 | 0.999 |
| 0.0924 | 0.999 |
| 0.09241 | 0.999 |
| 0.09242 | 0.999 |
| 0.09243 | 0.999 |
| 0.09244 | 0.999 |
| 0.09245 | 0.999 |
| 0.09246 | 0.999 |
| 0.09247 | 0.999 |
| 0.09248 | 0.999 |
| 0.09249 | 0.999 |
| 0.0925 | 0.999 |
| 0.09251 | 0.999 |
| 0.09252 | 0.999 |
| 0.09253 | 0.999 |
| 0.09254 | 0.999 |
| 0.09255 | 0.999 |
| 0.09256 | 0.999 |
| 0.09257 | 0.999 |
| 0.09258 | 0.999 |
| 0.09259 | 0.999 |
| 0.0926 | 0.999 |
| 0.09261 | 0.999 |
| 0.09262 | 0.999 |
| 0.09263 | 0.999 |
| 0.09264 | 0.999 |
| 0.09265 | 0.999 |
| 0.09266 | 0.999 |
| 0.09267 | 0.999 |
| 0.09268 | 0.999 |
| 0.09269 | 0.999 |
| 0.0927 | 0.999 |
| 0.09271 | 0.999 |
| 0.09272 | 0.999 |
| 0.09273 | 0.999 |
| 0.09274 | 0.999 |
| 0.09275 | 0.999 |
| 0.09276 | 0.999 |
| 0.09277 | 0.999 |
| 0.09278 | 0.999 |
| 0.09279 | 0.999 |
| 0.0928 | 0.999 |
| 0.09281 | 0.999 |
| 0.09282 | 0.999 |
| 0.09283 | 0.999 |
| 0.09284 | 0.999 |
| 0.09285 | 0.999 |
| 0.09286 | 0.999 |
| 0.09287 | 0.999 |
| 0.09288 | 0.999 |
| 0.09289 | 0.999 |
| 0.0929 | 0.999 |
| 0.09291 | 0.999 |
| 0.09292 | 0.999 |
| 0.09293 | 0.999 |
| 0.09294 | 0.999 |
| 0.09295 | 0.999 |
| 0.09296 | 0.999 |
| 0.09297 | 0.999 |
| 0.09298 | 0.999 |
| 0.09299 | 0.999 |
| 0.093 | 0.999 |
| 0.09301 | 0.999 |
| 0.09302 | 0.999 |
| 0.09303 | 0.999 |
| 0.09304 | 0.999 |
| 0.09305 | 0.999 |
| 0.09306 | 0.999 |
| 0.09307 | 0.999 |
| 0.09308 | 0.999 |
| 0.09309 | 0.999 |
| 0.0931 | 0.999 |
| 0.09311 | 0.999 |
| 0.09312 | 0.999 |
| 0.09313 | 0.999 |
| 0.09314 | 0.999 |
| 0.09315 | 0.999 |
| 0.09316 | 0.999 |
| 0.09317 | 0.999 |
| 0.09318 | 0.999 |
| 0.09319 | 0.999 |
| 0.0932 | 0.999 |
| 0.09321 | 0.999 |
| 0.09322 | 0.999 |
| 0.09323 | 0.999 |
| 0.09324 | 0.999 |
| 0.09325 | 0.999 |
| 0.09326 | 0.999 |
| 0.09327 | 0.999 |
| 0.09328 | 0.999 |
| 0.09329 | 0.999 |
| 0.0933 | 0.999 |
| 0.09331 | 0.999 |
| 0.09332 | 0.999 |
| 0.09333 | 0.999 |
| 0.09334 | 0.999 |
| 0.09335 | 0.999 |
| 0.09336 | 0.999 |
| 0.09337 | 0.999 |
| 0.09338 | 0.999 |
| 0.09339 | 0.999 |
| 0.0934 | 0.999 |
| 0.09341 | 0.999 |
| 0.09342 | 0.999 |
| 0.09343 | 0.999 |
| 0.09344 | 0.999 |
| 0.09345 | 0.999 |
| 0.09346 | 0.999 |
| 0.09347 | 0.999 |
| 0.09348 | 0.999 |
| 0.09349 | 0.999 |
| 0.0935 | 0.999 |
| 0.09351 | 0.999 |
| 0.09352 | 0.999 |
| 0.09353 | 0.999 |
| 0.09354 | 0.999 |
| 0.09355 | 0.999 |
| 0.09356 | 0.999 |
| 0.09357 | 0.999 |
| 0.09358 | 1 |
| 0.09359 | 1 |
| 0.0936 | 1 |
| 0.09361 | 1 |
| 0.09362 | 1 |
| 0.09363 | 1 |
| 0.09364 | 1 |
| 0.09365 | 1 |
| 0.09366 | 1 |
| 0.09367 | 1 |
| 0.09368 | 1 |
| 0.09369 | 1 |
| 0.0937 | 1 |
| 0.09371 | 1 |
| 0.09372 | 1 |
| 0.09373 | 1 |
| 0.09374 | 1 |
| 0.09375 | 1 |
| 0.09376 | 1 |
| 0.09377 | 1 |
| 0.09378 | 1 |
| 0.09379 | 1 |
| 0.0938 | 1 |
| 0.09381 | 1 |
| 0.09382 | 1 |
| 0.09383 | 1 |
| 0.09384 | 1 |
| 0.09385 | 1 |
| 0.09386 | 1 |
| 0.09387 | 1 |
| 0.09388 | 1 |
| 0.09389 | 1 |
| 0.0939 | 1 |
| 0.09391 | 1 |
| 0.09392 | 1 |
| 0.09393 | 1 |
| 0.09394 | 1 |
| 0.09395 | 1 |
| 0.09396 | 1 |
| 0.09397 | 1 |
| 0.09398 | 1 |
| 0.09399 | 1 |
| 0.094 | 1 |
| 0.09401 | 1 |
| 0.09402 | 1 |
| 0.09403 | 1 |
| 0.09404 | 1 |
| 0.09405 | 1 |
| 0.09406 | 1 |
| 0.09407 | 1 |
| 0.09408 | 1 |
| 0.09409 | 1 |
| 0.0941 | 1 |
| 0.09411 | 1 |
| 0.09412 | 1 |
| 0.09413 | 1 |
| 0.09414 | 1 |
| 0.09415 | 1 |
| 0.09416 | 1 |
| 0.09417 | 1 |
| 0.09418 | 1 |
| 0.09419 | 1 |
| 0.0942 | 1 |
| 0.09421 | 1 |
| 0.09422 | 1 |
| 0.09423 | 1 |
| 0.09424 | 1 |
| 0.09425 | 1 |
| 0.09426 | 1 |
| 0.09427 | 1 |
| 0.09428 | 1 |
| 0.09429 | 1 |
| 0.0943 | 1 |
| 0.09431 | 1 |
| 0.09432 | 1 |
| 0.09433 | 1 |
| 0.09434 | 1 |
| 0.09435 | 1 |
| 0.09436 | 1 |
| 0.09437 | 1 |
| 0.09438 | 1 |
| 0.09439 | 1 |
| 0.0944 | 1 |
| 0.09441 | 1 |
| 0.09442 | 1 |
| 0.09443 | 1 |
| 0.09444 | 1 |
| 0.09445 | 1 |
| 0.09446 | 1 |
| 0.09447 | 1 |
| 0.09448 | 1 |
| 0.09449 | 1 |
| 0.0945 | 1 |
| 0.09451 | 1 |
| 0.09452 | 1 |
| 0.09453 | 1 |
| 0.09454 | 1 |
| 0.09455 | 1 |
| 0.09456 | 1 |
| 0.09457 | 1 |
| 0.09458 | 1 |
| 0.09459 | 1 |
| 0.0946 | 1 |
| 0.09461 | 1 |
| 0.09462 | 1 |
| 0.09463 | 1 |
| 0.09464 | 1 |
| 0.09465 | 1 |
| 0.09466 | 1 |
| 0.09467 | 1 |
| 0.09468 | 1 |
| 0.09469 | 1 |
| 0.0947 | 1 |
| 0.09471 | 1 |
| 0.09472 | 1 |
| 0.09473 | 1 |
| 0.09474 | 1 |
| 0.09475 | 1 |
| 0.09476 | 1 |
| 0.09477 | 1 |
| 0.09478 | 1 |
| 0.09479 | 1 |
| 0.0948 | 1 |
| 0.09481 | 1 |
| 0.09482 | 1 |
| 0.09483 | 1 |
| 0.09484 | 1 |
| 0.09485 | 1 |
| 0.09486 | 1 |
| 0.09487 | 1 |
| 0.09488 | 1 |
| 0.09489 | 1 |
| 0.0949 | 1 |
| 0.09491 | 1 |
| 0.09492 | 1 |
| 0.09493 | 1 |
| 0.09494 | 1 |
| 0.09495 | 1 |
| 0.09496 | 1 |
| 0.09497 | 1 |
| 0.09498 | 1 |
| 0.09499 | 1 |
| 0.095 | 1 |
| 0.09501 | 1 |
| 0.09502 | 1 |
| 0.09503 | 1 |
| 0.09504 | 1 |
| 0.09505 | 1 |
| 0.09506 | 1 |
| 0.09507 | 1 |
| 0.09508 | 1 |
| 0.09509 | 1 |
| 0.0951 | 1 |
| 0.09511 | 1 |
| 0.09512 | 1 |
| 0.09513 | 1 |
| 0.09514 | 1 |
| 0.09515 | 1 |
| 0.09516 | 1 |
| 0.09517 | 1 |
| 0.09518 | 1 |
| 0.09519 | 1 |
| 0.0952 | 1 |
| 0.09521 | 1 |
| 0.09522 | 1 |
| 0.09523 | 1 |
| 0.09524 | 1 |
| 0.09525 | 1 |
| 0.09526 | 1 |
| 0.09527 | 1 |
| 0.09528 | 1 |
| 0.09529 | 1 |
| 0.0953 | 1 |
| 0.09531 | 1 |
| 0.09532 | 1 |
| 0.09533 | 1 |
| 0.09534 | 1 |
| 0.09535 | 1 |
| 0.09536 | 1 |
| 0.09537 | 1 |
| 0.09538 | 1 |
| 0.09539 | 1 |
| 0.0954 | 1 |
| 0.09541 | 1 |
| 0.09542 | 1 |
| 0.09543 | 1 |
| 0.09544 | 1 |
| 0.09545 | 1 |
| 0.09546 | 1 |
| 0.09547 | 1 |
| 0.09548 | 1 |
| 0.09549 | 1 |
| 0.0955 | 1 |
| 0.09551 | 1 |
| 0.09552 | 1 |
| 0.09553 | 1 |
| 0.09554 | 1 |
| 0.09555 | 1 |
| 0.09556 | 1 |
| 0.09557 | 1 |
| 0.09558 | 1 |
| 0.09559 | 1 |
| 0.0956 | 1 |
| 0.09561 | 1 |
| 0.09562 | 1 |
| 0.09563 | 1 |
| 0.09564 | 1 |
| 0.09565 | 1 |
| 0.09566 | 1 |
| 0.09567 | 1 |
| 0.09568 | 1 |
| 0.09569 | 1 |
| 0.0957 | 1 |
| 0.09571 | 1 |
| 0.09572 | 1 |
| 0.09573 | 1 |
| 0.09574 | 1 |
| 0.09575 | 1 |
| 0.09576 | 1 |
| 0.09577 | 1 |
| 0.09578 | 1 |
| 0.09579 | 1 |
| 0.0958 | 1 |
| 0.09581 | 1 |
| 0.09582 | 1 |
| 0.09583 | 1 |
| 0.09584 | 1 |
| 0.09585 | 1 |
| 0.09586 | 1 |
| 0.09587 | 1 |
| 0.09588 | 1 |
| 0.09589 | 1 |
| 0.0959 | 1 |
| 0.09591 | 1 |
| 0.09592 | 1 |
| 0.09593 | 1 |
| 0.09594 | 1 |
| 0.09595 | 1 |
| 0.09596 | 1 |
| 0.09597 | 1 |
| 0.09598 | 1 |
| 0.09599 | 1 |
| 0.096 | 1 |
| 0.09601 | 1 |
| 0.09602 | 1 |
| 0.09603 | 1 |
| 0.09604 | 1 |
| 0.09605 | 1 |
| 0.09606 | 1 |
| 0.09607 | 1 |
| 0.09608 | 1 |
| 0.09609 | 1 |
| 0.0961 | 1 |
| 0.09611 | 1 |
| 0.09612 | 1 |
| 0.09613 | 1 |
| 0.09614 | 1 |
| 0.09615 | 1 |
| 0.09616 | 1 |
| 0.09617 | 1 |
| 0.09618 | 1 |
| 0.09619 | 1 |
| 0.0962 | 1 |
| 0.09621 | 1 |
| 0.09622 | 1 |
| 0.09623 | 1 |
| 0.09624 | 1 |
| 0.09625 | 1 |
| 0.09626 | 1 |
| 0.09627 | 1 |
| 0.09628 | 1 |
| 0.09629 | 1 |
| 0.0963 | 1 |
| 0.09631 | 1 |
| 0.09632 | 1 |
| 0.09633 | 1 |
| 0.09634 | 1 |
| 0.09635 | 1 |
| 0.09636 | 1 |
| 0.09637 | 1 |
| 0.09638 | 1 |
| 0.09639 | 1 |
| 0.0964 | 1 |
| 0.09641 | 1 |
| 0.09642 | 1 |
| 0.09643 | 1 |
| 0.09644 | 1 |
| 0.09645 | 1 |
| 0.09646 | 1 |
| 0.09647 | 1 |
| 0.09648 | 1 |
| 0.09649 | 1 |
| 0.0965 | 1 |
| 0.09651 | 1 |
| 0.09652 | 1 |
| 0.09653 | 1 |
| 0.09654 | 1 |
| 0.09655 | 1 |
| 0.09656 | 1 |
| 0.09657 | 1 |
| 0.09658 | 1 |
| 0.09659 | 1 |
| 0.0966 | 1 |
| 0.09661 | 1 |
| 0.09662 | 1 |
| 0.09663 | 1 |
| 0.09664 | 1 |
| 0.09665 | 1 |
| 0.09666 | 1 |
| 0.09667 | 1 |
| 0.09668 | 1 |
| 0.09669 | 1 |
| 0.0967 | 1 |
| 0.09671 | 1 |
| 0.09672 | 1 |
| 0.09673 | 1 |
| 0.09674 | 1 |
| 0.09675 | 1 |
| 0.09676 | 1 |
| 0.09677 | 1 |
| 0.09678 | 1 |
| 0.09679 | 1 |
| 0.0968 | 1 |
| 0.09681 | 1 |
| 0.09682 | 1 |
| 0.09683 | 1 |
| 0.09684 | 1 |
| 0.09685 | 1 |
| 0.09686 | 1 |
| 0.09687 | 1 |
| 0.09688 | 1 |
| 0.09689 | 1 |
| 0.0969 | 1 |
| 0.09691 | 1 |
| 0.09692 | 1 |
| 0.09693 | 1 |
| 0.09694 | 1 |
| 0.09695 | 1 |
| 0.09696 | 1 |
| 0.09697 | 1 |
| 0.09698 | 1 |
| 0.09699 | 1 |
| 0.097 | 1 |
| 0.09701 | 1 |
| 0.09702 | 1 |
| 0.09703 | 1 |
| 0.09704 | 1 |
| 0.09705 | 1 |
| 0.09706 | 1 |
| 0.09707 | 1 |
| 0.09708 | 1 |
| 0.09709 | 1 |
| 0.0971 | 1 |
| 0.09711 | 1 |
| 0.09712 | 1 |
| 0.09713 | 1 |
| 0.09714 | 1 |
| 0.09715 | 1 |
| 0.09716 | 1 |
| 0.09717 | 1 |
| 0.09718 | 1 |
| 0.09719 | 1 |
| 0.0972 | 1 |
| 0.09721 | 1 |
| 0.09722 | 1 |
| 0.09723 | 1 |
| 0.09724 | 1 |
| 0.09725 | 1 |
| 0.09726 | 1 |
| 0.09727 | 1 |
| 0.09728 | 1 |
| 0.09729 | 1 |
| 0.0973 | 1 |
| 0.09731 | 1 |
| 0.09732 | 1 |
| 0.09733 | 1 |
| 0.09734 | 1 |
| 0.09735 | 1 |
| 0.09736 | 1 |
| 0.09737 | 1 |
| 0.09738 | 1 |
| 0.09739 | 1 |
| 0.0974 | 1 |
| 0.09741 | 1 |
| 0.09742 | 1 |
| 0.09743 | 1 |
| 0.09744 | 1 |
| 0.09745 | 1 |
| 0.09746 | 1 |
| 0.09747 | 1 |
| 0.09748 | 1 |
| 0.09749 | 1 |
| 0.0975 | 1 |
| 0.09751 | 1 |
| 0.09752 | 1 |
| 0.09753 | 1 |
| 0.09754 | 1 |
| 0.09755 | 1 |
| 0.09756 | 1 |
| 0.09757 | 1 |
| 0.09758 | 1 |
| 0.09759 | 1 |
| 0.0976 | 1 |
| 0.09761 | 1 |
| 0.09762 | 1 |
| 0.09763 | 1 |
| 0.09764 | 1 |
| 0.09765 | 1 |
| 0.09766 | 1 |
| 0.09767 | 1 |
| 0.09768 | 1 |
| 0.09769 | 1 |
| 0.0977 | 1 |
| 0.09771 | 1 |
| 0.09772 | 1 |
| 0.09773 | 1 |
| 0.09774 | 1 |
| 0.09775 | 1 |
| 0.09776 | 1 |
| 0.09777 | 1 |
| 0.09778 | 1 |
| 0.09779 | 1 |
| 0.0978 | 1 |
| 0.09781 | 1 |
| 0.09782 | 1 |
| 0.09783 | 1 |
| 0.09784 | 1 |
| 0.09785 | 1 |
| 0.09786 | 1 |
| 0.09787 | 1 |
| 0.09788 | 1 |
| 0.09789 | 1 |
| 0.0979 | 1 |
| 0.09791 | 1 |
| 0.09792 | 1 |
| 0.09793 | 1 |
| 0.09794 | 1 |
| 0.09795 | 1 |
| 0.09796 | 1 |
| 0.09797 | 1 |
| 0.09798 | 1 |
| 0.09799 | 1 |
| 0.098 | 1 |
| 0.09801 | 1 |
| 0.09802 | 1 |
| 0.09803 | 1 |
| 0.09804 | 1 |
| 0.09805 | 1 |
| 0.09806 | 1 |
| 0.09807 | 1 |
| 0.09808 | 1 |
| 0.09809 | 1 |
| 0.0981 | 1 |
| 0.09811 | 1 |
| 0.09812 | 1 |
| 0.09813 | 1 |
| 0.09814 | 1 |
| 0.09815 | 1 |
| 0.09816 | 1 |
| 0.09817 | 1 |
| 0.09818 | 1 |
| 0.09819 | 1 |
| 0.0982 | 1 |
| 0.09821 | 1 |
| 0.09822 | 1 |
| 0.09823 | 1 |
| 0.09824 | 1 |
| 0.09825 | 1 |
| 0.09826 | 1 |
| 0.09827 | 1 |
| 0.09828 | 1 |
| 0.09829 | 1 |
| 0.0983 | 1 |
| 0.09831 | 1 |
| 0.09832 | 1 |
| 0.09833 | 1 |
| 0.09834 | 1 |
| 0.09835 | 1 |
| 0.09836 | 1 |
| 0.09837 | 1 |
| 0.09838 | 1 |
| 0.09839 | 1 |
| 0.0984 | 1 |
| 0.09841 | 1 |
| 0.09842 | 1 |
| 0.09843 | 1 |
| 0.09844 | 1 |
| 0.09845 | 1 |
| 0.09846 | 1 |
| 0.09847 | 1 |
| 0.09848 | 1 |
| 0.09849 | 1 |
| 0.0985 | 1 |
| 0.09851 | 1 |
| 0.09852 | 1 |
| 0.09853 | 1 |
| 0.09854 | 1 |
| 0.09855 | 1 |
| 0.09856 | 1 |
| 0.09857 | 1 |
| 0.09858 | 1 |
| 0.09859 | 1 |
| 0.0986 | 1 |
| 0.09861 | 1 |
| 0.09862 | 1 |
| 0.09863 | 1 |
| 0.09864 | 1 |
| 0.09865 | 1 |
| 0.09866 | 1 |
| 0.09867 | 1 |
| 0.09868 | 1 |
| 0.09869 | 1 |
| 0.0987 | 1 |
| 0.09871 | 1 |
| 0.09872 | 1 |
| 0.09873 | 1 |
| 0.09874 | 1 |
| 0.09875 | 1 |
| 0.09876 | 1 |
| 0.09877 | 1 |
| 0.09878 | 1 |
| 0.09879 | 1 |
| 0.0988 | 1 |
| 0.09881 | 1 |
| 0.09882 | 1 |
| 0.09883 | 1 |
| 0.09884 | 1 |
| 0.09885 | 1 |
| 0.09886 | 1 |
| 0.09887 | 1 |
| 0.09888 | 1 |
| 0.09889 | 1 |
| 0.0989 | 1 |
| 0.09891 | 1 |
| 0.09892 | 1 |
| 0.09893 | 1 |
| 0.09894 | 1 |
| 0.09895 | 1 |
| 0.09896 | 1 |
| 0.09897 | 1 |
| 0.09898 | 1 |
| 0.09899 | 1 |
| 0.099 | 1 |
| 0.09901 | 1 |
| 0.09902 | 1 |
| 0.09903 | 1 |
| 0.09904 | 1 |
| 0.09905 | 1 |
| 0.09906 | 1 |
| 0.09907 | 1 |
| 0.09908 | 1 |
| 0.09909 | 1 |
| 0.0991 | 1 |
| 0.09911 | 1 |
| 0.09912 | 1 |
| 0.09913 | 1 |
| 0.09914 | 1 |
| 0.09915 | 1 |
| 0.09916 | 1 |
| 0.09917 | 1 |
| 0.09918 | 1 |
| 0.09919 | 1 |
| 0.0992 | 1 |
| 0.09921 | 1 |
| 0.09922 | 1 |
| 0.09923 | 1 |
| 0.09924 | 1 |
| 0.09925 | 1 |
| 0.09926 | 1 |
| 0.09927 | 1 |
| 0.09928 | 1 |
| 0.09929 | 1 |
| 0.0993 | 1 |
| 0.09931 | 1 |
| 0.09932 | 1 |
| 0.09933 | 1 |
| 0.09934 | 1 |
| 0.09935 | 1 |
| 0.09936 | 1 |
| 0.09937 | 1 |
| 0.09938 | 1 |
| 0.09939 | 1 |
| 0.0994 | 1 |
| 0.09941 | 1 |
| 0.09942 | 1 |
| 0.09943 | 1 |
| 0.09944 | 1 |
| 0.09945 | 1 |
| 0.09946 | 1 |
| 0.09947 | 1 |
| 0.09948 | 1 |
| 0.09949 | 1 |
| 0.0995 | 1 |
| 0.09951 | 1 |
| 0.09952 | 1 |
| 0.09953 | 1 |
| 0.09954 | 1 |
| 0.09955 | 1 |
| 0.09956 | 1 |
| 0.09957 | 1 |
| 0.09958 | 1 |
| 0.09959 | 1 |
| 0.0996 | 1 |
| 0.09961 | 1 |
| 0.09962 | 1 |
| 0.09963 | 1 |
| 0.09964 | 1 |
| 0.09965 | 1 |
| 0.09966 | 1 |
| 0.09967 | 1 |
| 0.09968 | 1 |
| 0.09969 | 1 |
| 0.0997 | 1 |
| 0.09971 | 1 |
| 0.09972 | 1 |
| 0.09973 | 1 |
| 0.09974 | 1 |
| 0.09975 | 1 |
| 0.09976 | 1 |
| 0.09977 | 1 |
| 0.09978 | 1 |
| 0.09979 | 1 |
| 0.0998 | 1 |
| 0.09981 | 1 |
| 0.09982 | 1 |
| 0.09983 | 1 |
| 0.09984 | 1 |
| 0.09985 | 1 |
| 0.09986 | 1 |
| 0.09987 | 1 |
| 0.09988 | 1 |
| 0.09989 | 1 |
| 0.0999 | 1 |
| 0.09991 | 1 |
| 0.09992 | 1 |
| 0.09993 | 1 |
| 0.09994 | 1 |
| 0.09995 | 1 |
| 0.09996 | 1 |
| 0.09997 | 1 |
| 0.09998 | 1 |
| 0.09999 | 1 |
| 0.1 | 1 |
| 0.10001 | 1 |
| 0.10002 | 1 |
| 0.10003 | 1 |
| 0.10004 | 1 |
| 0.10005 | 1 |
| 0.10006 | 1 |
| 0.10007 | 1 |
| 0.10008 | 1 |
| 0.10009 | 1 |
| 0.1001 | 1 |
| 0.10011 | 1 |
| 0.10012 | 1 |
| 0.10013 | 1 |
| 0.10014 | 1 |
| 0.10015 | 1 |
| 0.10016 | 1 |
| 0.10017 | 1 |
| 0.10018 | 1 |
| 0.10019 | 1 |
| 0.1002 | 1 |
| 0.10021 | 1 |
| 0.10022 | 1 |
| 0.10023 | 1 |
| 0.10024 | 1 |
| 0.10025 | 1 |
| 0.10026 | 1 |
| 0.10027 | 1 |
| 0.10028 | 1 |
| 0.10029 | 1 |
| 0.1003 | 1 |
| 0.10031 | 1 |
| 0.10032 | 1 |
| 0.10033 | 1 |
| 0.10034 | 1 |
| 0.10035 | 1 |
| 0.10036 | 1 |
| 0.10037 | 1 |
| 0.10038 | 1 |
| 0.10039 | 1 |
| 0.1004 | 1 |
| 0.10041 | 1 |
| 0.10042 | 1 |
| 0.10043 | 1 |
| 0.10044 | 1 |
| 0.10045 | 1 |
| 0.10046 | 1 |
| 0.10047 | 1 |
| 0.10048 | 1 |
| 0.10049 | 1 |
| 0.1005 | 1 |
| 0.10051 | 1 |
| 0.10052 | 1 |
| 0.10053 | 1 |
| 0.10054 | 1 |
| 0.10055 | 1 |
| 0.10056 | 1 |
| 0.10057 | 1 |
| 0.10058 | 1 |
| 0.10059 | 1 |
| 0.1006 | 1 |
| 0.10061 | 1 |
| 0.10062 | 1 |
| 0.10063 | 1 |
| 0.10064 | 1 |
| 0.10065 | 1 |
| 0.10066 | 1 |
| 0.10067 | 1 |
| 0.10068 | 1 |
| 0.10069 | 1 |
| 0.1007 | 1 |
| 0.10071 | 1 |
| 0.10072 | 1 |
| 0.10073 | 1 |
| 0.10074 | 1 |
| 0.10075 | 1 |
| 0.10076 | 1 |
| 0.10077 | 1 |
| 0.10078 | 1 |
| 0.10079 | 1 |
| 0.1008 | 1 |
| 0.10081 | 1 |
| 0.10082 | 1 |
| 0.10083 | 1 |
| 0.10084 | 1 |
| 0.10085 | 1 |
| 0.10086 | 1 |
| 0.10087 | 1 |
| 0.10088 | 1 |
| 0.10089 | 1 |
| 0.1009 | 1 |
| 0.10091 | 1 |
| 0.10092 | 1 |
| 0.10093 | 1 |
| 0.10094 | 1 |
| 0.10095 | 1 |
| 0.10096 | 1 |
| 0.10097 | 1 |
| 0.10098 | 1 |
| 0.10099 | 1 |
| 0.101 | 1 |
| 0.10101 | 1 |
| 0.10102 | 1 |
| 0.10103 | 1 |
| 0.10104 | 1 |
| 0.10105 | 1 |
| 0.10106 | 1 |
| 0.10107 | 1 |
| 0.10108 | 1 |
| 0.10109 | 1 |
| 0.1011 | 1 |
| 0.10111 | 1 |
| 0.10112 | 1 |
| 0.10113 | 1 |
| 0.10114 | 1 |
| 0.10115 | 1 |
| 0.10116 | 1 |
| 0.10117 | 1 |
| 0.10118 | 1 |
| 0.10119 | 1 |
| 0.1012 | 1 |
| 0.10121 | 1 |
| 0.10122 | 1 |
| 0.10123 | 1 |
| 0.10124 | 1 |
| 0.10125 | 1 |
| 0.10126 | 1 |
| 0.10127 | 1 |
| 0.10128 | 1 |
| 0.10129 | 1 |
| 0.1013 | 1 |
| 0.10131 | 1 |
| 0.10132 | 1 |
| 0.10133 | 1 |
| 0.10134 | 1 |
| 0.10135 | 1 |
| 0.10136 | 1 |
| 0.10137 | 1 |
| 0.10138 | 1 |
| 0.10139 | 1 |
| 0.1014 | 1 |
| 0.10141 | 1 |
| 0.10142 | 1 |
| 0.10143 | 1 |
| 0.10144 | 1 |
| 0.10145 | 1 |
| 0.10146 | 1 |
| 0.10147 | 1 |
| 0.10148 | 1 |
| 0.10149 | 1 |
| 0.1015 | 1 |
| 0.10151 | 1 |
| 0.10152 | 1 |
| 0.10153 | 1 |
| 0.10154 | 1 |
| 0.10155 | 1 |
| 0.10156 | 1 |
| 0.10157 | 1 |
| 0.10158 | 1 |
| 0.10159 | 1 |
| 0.1016 | 1 |
| 0.10161 | 1 |
| 0.10162 | 1 |
| 0.10163 | 1 |
| 0.10164 | 1 |
| 0.10165 | 1 |
| 0.10166 | 1 |
| 0.10167 | 1 |
| 0.10168 | 1 |
| 0.10169 | 1 |
| 0.1017 | 1 |
| 0.10171 | 1 |
| 0.10172 | 1 |
| 0.10173 | 1 |
| 0.10174 | 1 |
| 0.10175 | 1 |
| 0.10176 | 1 |
| 0.10177 | 1 |
| 0.10178 | 1 |
| 0.10179 | 1 |
| 0.1018 | 1 |
| 0.10181 | 1 |
| 0.10182 | 1 |
| 0.10183 | 1 |
| 0.10184 | 1 |
| 0.10185 | 1 |
| 0.10186 | 1 |
| 0.10187 | 1 |
| 0.10188 | 1 |
| 0.10189 | 1 |
| 0.1019 | 1 |
| 0.10191 | 1 |
| 0.10192 | 1 |
| 0.10193 | 1 |
| 0.10194 | 1 |
| 0.10195 | 1 |
| 0.10196 | 1 |
| 0.10197 | 1 |
| 0.10198 | 1 |
| 0.10199 | 1 |
| 0.102 | 1 |
| 0.10201 | 1 |
| 0.10202 | 1 |
| 0.10203 | 1 |
| 0.10204 | 1 |
| 0.10205 | 1 |
| 0.10206 | 1 |
| 0.10207 | 1 |
| 0.10208 | 1 |
| 0.10209 | 1 |
| 0.1021 | 1 |
| 0.10211 | 1 |
| 0.10212 | 1 |
| 0.10213 | 1 |
| 0.10214 | 1 |
| 0.10215 | 1 |
| 0.10216 | 1 |
| 0.10217 | 1 |
| 0.10218 | 1 |
| 0.10219 | 1 |
| 0.1022 | 1 |
| 0.10221 | 1 |
| 0.10222 | 1 |
| 0.10223 | 1 |
| 0.10224 | 1 |
| 0.10225 | 1 |
| 0.10226 | 1 |
| 0.10227 | 1 |
| 0.10228 | 1 |
| 0.10229 | 1 |
| 0.1023 | 1 |
| 0.10231 | 1 |
| 0.10232 | 1 |
| 0.10233 | 1 |
| 0.10234 | 1 |
| 0.10235 | 1 |
| 0.10236 | 1 |
| 0.10237 | 1 |
| 0.10238 | 1 |
| 0.10239 | 1 |
| 0.1024 | 1 |
| 0.10241 | 1 |
| 0.10242 | 1 |
| 0.10243 | 1 |
| 0.10244 | 1 |
| 0.10245 | 1 |
| 0.10246 | 1 |
| 0.10247 | 1 |
| 0.10248 | 1 |
| 0.10249 | 1 |
| 0.1025 | 1 |
| 0.10251 | 1 |
| 0.10252 | 1 |
| 0.10253 | 1 |
| 0.10254 | 1 |
| 0.10255 | 1 |
| 0.10256 | 1 |
| 0.10257 | 1 |
| 0.10258 | 1 |
| 0.10259 | 1 |
| 0.1026 | 1 |
| 0.10261 | 1 |
| 0.10262 | 1 |
| 0.10263 | 1 |
| 0.10264 | 1 |
| 0.10265 | 1 |
| 0.10266 | 1 |
| 0.10267 | 1 |
| 0.10268 | 1 |
| 0.10269 | 1 |
| 0.1027 | 1 |
| 0.10271 | 1 |
| 0.10272 | 1 |
| 0.10273 | 1 |
| 0.10274 | 1 |
| 0.10275 | 1 |
| 0.10276 | 1 |
| 0.10277 | 1 |
| 0.10278 | 1 |
| 0.10279 | 1 |
| 0.1028 | 1 |
| 0.10281 | 1 |
| 0.10282 | 1 |
| 0.10283 | 1 |
| 0.10284 | 1 |
| 0.10285 | 1 |
| 0.10286 | 1 |
| 0.10287 | 1 |
| 0.10288 | 1 |
| 0.10289 | 1 |
| 0.1029 | 1 |
| 0.10291 | 1 |
| 0.10292 | 1 |
| 0.10293 | 1 |
| 0.10294 | 1 |
| 0.10295 | 1 |
| 0.10296 | 1 |
| 0.10297 | 1 |
| 0.10298 | 1 |
| 0.10299 | 1 |
| 0.103 | 1 |
| 0.10301 | 1 |
| 0.10302 | 1 |
| 0.10303 | 1 |
| 0.10304 | 1 |
| 0.10305 | 1 |
| 0.10306 | 1 |
| 0.10307 | 1 |
| 0.10308 | 1 |
| 0.10309 | 1 |
| 0.1031 | 1 |
| 0.10311 | 1 |
| 0.10312 | 1 |
| 0.10313 | 1 |
| 0.10314 | 1 |
| 0.10315 | 1 |
| 0.10316 | 1 |
| 0.10317 | 1 |
| 0.10318 | 1 |
| 0.10319 | 1 |
| 0.1032 | 1 |
| 0.10321 | 1 |
| 0.10322 | 1 |
| 0.10323 | 1 |
| 0.10324 | 1 |
| 0.10325 | 1 |
| 0.10326 | 1 |
| 0.10327 | 1 |
| 0.10328 | 1 |
| 0.10329 | 1 |
| 0.1033 | 1 |
| 0.10331 | 1 |
| 0.10332 | 1 |
| 0.10333 | 1 |
| 0.10334 | 1 |
| 0.10335 | 1 |
| 0.10336 | 1 |
| 0.10337 | 1 |
| 0.10338 | 1 |
| 0.10339 | 1 |
| 0.1034 | 1 |
| 0.10341 | 1 |
| 0.10342 | 1 |
| 0.10343 | 1 |
| 0.10344 | 1 |
| 0.10345 | 1 |
| 0.10346 | 1 |
| 0.10347 | 1 |
| 0.10348 | 1 |
| 0.10349 | 1 |
| 0.1035 | 1 |
| 0.10351 | 1 |
| 0.10352 | 1 |
| 0.10353 | 1 |
| 0.10354 | 1 |
| 0.10355 | 1 |
| 0.10356 | 1 |
| 0.10357 | 1 |
| 0.10358 | 1 |
| 0.10359 | 1 |
| 0.1036 | 1 |
| 0.10361 | 1 |
| 0.10362 | 1 |
| 0.10363 | 1 |
| 0.10364 | 1 |
| 0.10365 | 1 |
| 0.10366 | 1 |
| 0.10367 | 1 |
| 0.10368 | 1 |
| 0.10369 | 1 |
| 0.1037 | 1 |
| 0.10371 | 1 |
| 0.10372 | 1 |
| 0.10373 | 1 |
| 0.10374 | 1 |
| 0.10375 | 1 |
| 0.10376 | 1 |
| 0.10377 | 1 |
| 0.10378 | 1 |
| 0.10379 | 1 |
| 0.1038 | 1 |
| 0.10381 | 1 |
| 0.10382 | 1 |
| 0.10383 | 1 |
| 0.10384 | 1 |
| 0.10385 | 1 |
| 0.10386 | 1 |
| 0.10387 | 1 |
| 0.10388 | 1 |
| 0.10389 | 1 |
| 0.1039 | 1 |
| 0.10391 | 1 |
| 0.10392 | 1 |
| 0.10393 | 1 |
| 0.10394 | 1 |
| 0.10395 | 1 |
| 0.10396 | 1 |
| 0.10397 | 1 |
| 0.10398 | 1 |
| 0.10399 | 1 |
| 0.104 | 1 |
| 0.10401 | 1 |
| 0.10402 | 1 |
| 0.10403 | 1 |
| 0.10404 | 1 |
| 0.10405 | 1 |
| 0.10406 | 1 |
| 0.10407 | 1 |
| 0.10408 | 1 |
| 0.10409 | 1 |
| 0.1041 | 1 |
| 0.10411 | 1 |
| 0.10412 | 1 |
| 0.10413 | 1 |
| 0.10414 | 1 |
| 0.10415 | 1 |
| 0.10416 | 1 |
| 0.10417 | 1 |
| 0.10418 | 1 |
| 0.10419 | 1 |
| 0.1042 | 1 |
| 0.10421 | 1 |
| 0.10422 | 1 |
| 0.10423 | 1 |
| 0.10424 | 1 |
| 0.10425 | 1 |
| 0.10426 | 1 |
| 0.10427 | 1 |
| 0.10428 | 1 |
| 0.10429 | 1 |
| 0.1043 | 1 |
| 0.10431 | 1 |
| 0.10432 | 1 |
| 0.10433 | 1 |
| 0.10434 | 1 |
| 0.10435 | 1 |
| 0.10436 | 1 |
| 0.10437 | 1 |
| 0.10438 | 1 |
| 0.10439 | 1 |
| 0.1044 | 1 |
| 0.10441 | 1 |
| 0.10442 | 1 |
| 0.10443 | 1 |
| 0.10444 | 1 |
| 0.10445 | 1 |
| 0.10446 | 1 |
| 0.10447 | 1 |
| 0.10448 | 1 |
| 0.10449 | 1 |
| 0.1045 | 1 |
| 0.10451 | 1 |
| 0.10452 | 1 |
| 0.10453 | 1 |
| 0.10454 | 1 |
| 0.10455 | 1 |
| 0.10456 | 1 |
| 0.10457 | 1 |
| 0.10458 | 1 |
| 0.10459 | 1 |
| 0.1046 | 1 |
| 0.10461 | 1 |
| 0.10462 | 1 |
| 0.10463 | 1 |
| 0.10464 | 1 |
| 0.10465 | 1 |
| 0.10466 | 1 |
| 0.10467 | 1 |
| 0.10468 | 1 |
| 0.10469 | 1 |
| 0.1047 | 1 |
| 0.10471 | 1 |
| 0.10472 | 1 |
| 0.10473 | 1 |
| 0.10474 | 1 |
| 0.10475 | 1 |
| 0.10476 | 1 |
| 0.10477 | 1 |
| 0.10478 | 1 |
| 0.10479 | 1 |
| 0.1048 | 1 |
| 0.10481 | 1 |
| 0.10482 | 1 |
| 0.10483 | 1 |
| 0.10484 | 1 |
| 0.10485 | 1 |
| 0.10486 | 1 |
| 0.10487 | 1 |
| 0.10488 | 1 |
| 0.10489 | 1 |
| 0.1049 | 1 |
| 0.10491 | 1 |
| 0.10492 | 1 |
| 0.10493 | 1 |
| 0.10494 | 1 |
| 0.10495 | 1 |
| 0.10496 | 1 |
| 0.10497 | 1 |
| 0.10498 | 1 |
| 0.10499 | 1 |
| 0.105 | 1 |
| 0.10501 | 1 |
| 0.10502 | 1 |
| 0.10503 | 1 |
| 0.10504 | 1 |
| 0.10505 | 1 |
| 0.10506 | 1 |
| 0.10507 | 1 |
| 0.10508 | 1 |
| 0.10509 | 1 |
| 0.1051 | 1 |
| 0.10511 | 1 |
| 0.10512 | 1 |
| 0.10513 | 1 |
| 0.10514 | 1 |
| 0.10515 | 1 |
| 0.10516 | 1 |
| 0.10517 | 1 |
| 0.10518 | 1 |
| 0.10519 | 1 |
| 0.1052 | 1 |
| 0.10521 | 1 |
| 0.10522 | 1 |
| 0.10523 | 1 |
| 0.10524 | 1 |
| 0.10525 | 1 |
| 0.10526 | 1 |
| 0.10527 | 1 |
| 0.10528 | 1 |
| 0.10529 | 1 |
| 0.1053 | 1 |
| 0.10531 | 1 |
| 0.10532 | 1 |
| 0.10533 | 1 |
| 0.10534 | 1 |
| 0.10535 | 1 |
| 0.10536 | 1 |
| 0.10537 | 1 |
| 0.10538 | 1 |
| 0.10539 | 1 |
| 0.1054 | 1 |
| 0.10541 | 1 |
| 0.10542 | 1 |
| 0.10543 | 1 |
| 0.10544 | 1 |
| 0.10545 | 1 |
| 0.10546 | 1 |
| 0.10547 | 0.999 |
| 0.10548 | 1 |
| 0.10549 | 0.999 |
| 0.1055 | 0.999 |
| 0.10551 | 0.999 |
| 0.10552 | 0.999 |
| 0.10553 | 0.999 |
| 0.10554 | 0.999 |
| 0.10555 | 0.999 |
| 0.10556 | 0.999 |
| 0.10557 | 0.999 |
| 0.10558 | 0.999 |
| 0.10559 | 0.999 |
| 0.1056 | 0.999 |
| 0.10561 | 0.999 |
| 0.10562 | 0.999 |
| 0.10563 | 0.999 |
| 0.10564 | 0.999 |
| 0.10565 | 0.999 |
| 0.10566 | 0.999 |
| 0.10567 | 0.999 |
| 0.10568 | 0.999 |
| 0.10569 | 0.999 |
| 0.1057 | 0.999 |
| 0.10571 | 0.999 |
| 0.10572 | 0.999 |
| 0.10573 | 0.999 |
| 0.10574 | 0.999 |
| 0.10575 | 0.999 |
| 0.10576 | 0.999 |
| 0.10577 | 0.999 |
| 0.10578 | 0.999 |
| 0.10579 | 0.999 |
| 0.1058 | 0.999 |
| 0.10581 | 0.999 |
| 0.10582 | 0.999 |
| 0.10583 | 0.999 |
| 0.10584 | 0.999 |
| 0.10585 | 0.999 |
| 0.10586 | 0.999 |
| 0.10587 | 0.999 |
| 0.10588 | 0.999 |
| 0.10589 | 0.999 |
| 0.1059 | 0.999 |
| 0.10591 | 0.999 |
| 0.10592 | 0.999 |
| 0.10593 | 0.999 |
| 0.10594 | 0.999 |
| 0.10595 | 0.999 |
| 0.10596 | 0.999 |
| 0.10597 | 0.999 |
| 0.10598 | 0.999 |
| 0.10599 | 0.999 |
| 0.106 | 0.999 |
| 0.10601 | 0.999 |
| 0.10602 | 0.999 |
| 0.10603 | 0.999 |
| 0.10604 | 0.999 |
| 0.10605 | 0.999 |
| 0.10606 | 0.999 |
| 0.10607 | 0.999 |
| 0.10608 | 0.999 |
| 0.10609 | 0.999 |
| 0.1061 | 0.999 |
| 0.10611 | 0.999 |
| 0.10612 | 0.999 |
| 0.10613 | 0.999 |
| 0.10614 | 0.999 |
| 0.10615 | 0.999 |
| 0.10616 | 0.999 |
| 0.10617 | 0.999 |
| 0.10618 | 0.999 |
| 0.10619 | 0.999 |
| 0.1062 | 0.999 |
| 0.10621 | 0.999 |
| 0.10622 | 0.999 |
| 0.10623 | 0.999 |
| 0.10624 | 0.999 |
| 0.10625 | 0.999 |
| 0.10626 | 0.999 |
| 0.10627 | 0.999 |
| 0.10628 | 0.999 |
| 0.10629 | 0.999 |
| 0.1063 | 0.999 |
| 0.10631 | 0.999 |
| 0.10632 | 0.999 |
| 0.10633 | 0.999 |
| 0.10634 | 0.999 |
| 0.10635 | 0.999 |
| 0.10636 | 0.999 |
| 0.10637 | 0.999 |
| 0.10638 | 0.999 |
| 0.10639 | 0.999 |
| 0.1064 | 0.999 |
| 0.10641 | 0.999 |
| 0.10642 | 0.999 |
| 0.10643 | 0.999 |
| 0.10644 | 0.999 |
| 0.10645 | 0.999 |
| 0.10646 | 0.999 |
| 0.10647 | 0.999 |
| 0.10648 | 0.999 |
| 0.10649 | 0.999 |
| 0.1065 | 0.999 |
| 0.10651 | 0.999 |
| 0.10652 | 0.999 |
| 0.10653 | 0.999 |
| 0.10654 | 0.999 |
| 0.10655 | 0.999 |
| 0.10656 | 0.999 |
| 0.10657 | 0.999 |
| 0.10658 | 0.999 |
| 0.10659 | 0.999 |
| 0.1066 | 0.999 |
| 0.10661 | 0.999 |
| 0.10662 | 0.999 |
| 0.10663 | 0.999 |
| 0.10664 | 0.999 |
| 0.10665 | 0.999 |
| 0.10666 | 0.999 |
| 0.10667 | 0.999 |
| 0.10668 | 0.999 |
| 0.10669 | 0.999 |
| 0.1067 | 0.999 |
| 0.10671 | 0.999 |
| 0.10672 | 0.999 |
| 0.10673 | 0.999 |
| 0.10674 | 0.999 |
| 0.10675 | 0.999 |
| 0.10676 | 0.999 |
| 0.10677 | 0.999 |
| 0.10678 | 0.999 |
| 0.10679 | 0.999 |
| 0.1068 | 0.999 |
| 0.10681 | 0.999 |
| 0.10682 | 0.999 |
| 0.10683 | 0.999 |
| 0.10684 | 0.999 |
| 0.10685 | 0.999 |
| 0.10686 | 0.999 |
| 0.10687 | 0.999 |
| 0.10688 | 0.999 |
| 0.10689 | 0.999 |
| 0.1069 | 0.999 |
| 0.10691 | 0.999 |
| 0.10692 | 0.999 |
| 0.10693 | 0.999 |
| 0.10694 | 0.999 |
| 0.10695 | 0.999 |
| 0.10696 | 0.999 |
| 0.10697 | 0.999 |
| 0.10698 | 0.999 |
| 0.10699 | 0.999 |
| 0.107 | 0.999 |
| 0.10701 | 0.999 |
| 0.10702 | 0.999 |
| 0.10703 | 0.999 |
| 0.10704 | 0.999 |
| 0.10705 | 0.999 |
| 0.10706 | 0.999 |
| 0.10707 | 0.999 |
| 0.10708 | 0.999 |
| 0.10709 | 0.999 |
| 0.1071 | 0.999 |
| 0.10711 | 0.999 |
| 0.10712 | 0.999 |
| 0.10713 | 0.999 |
| 0.10714 | 0.999 |
| 0.10715 | 0.999 |
| 0.10716 | 0.999 |
| 0.10717 | 0.999 |
| 0.10718 | 0.999 |
| 0.10719 | 0.999 |
| 0.1072 | 0.999 |
| 0.10721 | 0.999 |
| 0.10722 | 0.999 |
| 0.10723 | 0.999 |
| 0.10724 | 0.999 |
| 0.10725 | 0.999 |
| 0.10726 | 0.999 |
| 0.10727 | 0.999 |
| 0.10728 | 0.999 |
| 0.10729 | 0.999 |
| 0.1073 | 0.999 |
| 0.10731 | 0.999 |
| 0.10732 | 0.999 |
| 0.10733 | 0.999 |
| 0.10734 | 0.999 |
| 0.10735 | 0.999 |
| 0.10736 | 0.999 |
| 0.10737 | 0.999 |
| 0.10738 | 0.999 |
| 0.10739 | 0.999 |
| 0.1074 | 0.999 |
| 0.10741 | 0.999 |
| 0.10742 | 0.999 |
| 0.10743 | 0.999 |
| 0.10744 | 0.999 |
| 0.10745 | 0.999 |
| 0.10746 | 1 |
| 0.10747 | 1 |
| 0.10748 | 1 |
| 0.10749 | 1 |
| 0.1075 | 1 |
| 0.10751 | 1 |
| 0.10752 | 1 |
| 0.10753 | 1 |
| 0.10754 | 1 |
| 0.10755 | 1 |
| 0.10756 | 1 |
| 0.10757 | 1 |
| 0.10758 | 1 |
| 0.10759 | 1 |
| 0.1076 | 1 |
| 0.10761 | 1 |
| 0.10762 | 1 |
| 0.10763 | 1 |
| 0.10764 | 1 |
| 0.10765 | 1 |
| 0.10766 | 1 |
| 0.10767 | 1 |
| 0.10768 | 1 |
| 0.10769 | 1 |
| 0.1077 | 1 |
| 0.10771 | 1 |
| 0.10772 | 1 |
| 0.10773 | 1 |
| 0.10774 | 1 |
| 0.10775 | 1 |
| 0.10776 | 1 |
| 0.10777 | 1 |
| 0.10778 | 1 |
| 0.10779 | 1 |
| 0.1078 | 1 |
| 0.10781 | 1 |
| 0.10782 | 1 |
| 0.10783 | 1 |
| 0.10784 | 1 |
| 0.10785 | 1 |
| 0.10786 | 1 |
| 0.10787 | 1 |
| 0.10788 | 1 |
| 0.10789 | 1 |
| 0.1079 | 1 |
| 0.10791 | 1 |
| 0.10792 | 1 |
| 0.10793 | 1 |
| 0.10794 | 1 |
| 0.10795 | 1 |
| 0.10796 | 1 |
| 0.10797 | 1 |
| 0.10798 | 1 |
| 0.10799 | 1 |
| 0.108 | 1 |
| 0.10801 | 1 |
| 0.10802 | 1 |
| 0.10803 | 1 |
| 0.10804 | 1 |
| 0.10805 | 1 |
| 0.10806 | 1 |
| 0.10807 | 1 |
| 0.10808 | 1 |
| 0.10809 | 1 |
| 0.1081 | 1 |
| 0.10811 | 1 |
| 0.10812 | 1 |
| 0.10813 | 1 |
| 0.10814 | 1 |
| 0.10815 | 1 |
| 0.10816 | 1 |
| 0.10817 | 1 |
| 0.10818 | 1 |
| 0.10819 | 1 |
| 0.1082 | 1 |
| 0.10821 | 1 |
| 0.10822 | 1 |
| 0.10823 | 1 |
| 0.10824 | 1 |
| 0.10825 | 1 |
| 0.10826 | 1 |
| 0.10827 | 1 |
| 0.10828 | 1 |
| 0.10829 | 1 |
| 0.1083 | 1 |
| 0.10831 | 1 |
| 0.10832 | 1 |
| 0.10833 | 1 |
| 0.10834 | 1 |
| 0.10835 | 1 |
| 0.10836 | 1 |
| 0.10837 | 1 |
| 0.10838 | 1 |
| 0.10839 | 1 |
| 0.1084 | 1 |
| 0.10841 | 1 |
| 0.10842 | 1 |
| 0.10843 | 1 |
| 0.10844 | 1 |
| 0.10845 | 1 |
| 0.10846 | 1 |
| 0.10847 | 1 |
| 0.10848 | 1 |
| 0.10849 | 1 |
| 0.1085 | 1 |
| 0.10851 | 1 |
| 0.10852 | 1 |
| 0.10853 | 1 |
| 0.10854 | 1 |
| 0.10855 | 1 |
| 0.10856 | 1 |
| 0.10857 | 1 |
| 0.10858 | 1 |
| 0.10859 | 1 |
| 0.1086 | 1 |
| 0.10861 | 1 |
| 0.10862 | 1 |
| 0.10863 | 1 |
| 0.10864 | 1 |
| 0.10865 | 1 |
| 0.10866 | 1 |
| 0.10867 | 1 |
| 0.10868 | 1 |
| 0.10869 | 1 |
| 0.1087 | 1 |
| 0.10871 | 1 |
| 0.10872 | 1 |
| 0.10873 | 1 |
| 0.10874 | 1 |
| 0.10875 | 1 |
| 0.10876 | 1 |
| 0.10877 | 1 |
| 0.10878 | 1 |
| 0.10879 | 1 |
| 0.1088 | 1 |
| 0.10881 | 1 |
| 0.10882 | 1 |
| 0.10883 | 1 |
| 0.10884 | 1 |
| 0.10885 | 1 |
| 0.10886 | 1 |
| 0.10887 | 1 |
| 0.10888 | 1 |
| 0.10889 | 1 |
| 0.1089 | 1 |
| 0.10891 | 1 |
| 0.10892 | 1 |
| 0.10893 | 1 |
| 0.10894 | 1 |
| 0.10895 | 1 |
| 0.10896 | 1 |
| 0.10897 | 1 |
| 0.10898 | 1 |
| 0.10899 | 1 |
| 0.109 | 1 |
| 0.10901 | 1 |
| 0.10902 | 1 |
| 0.10903 | 1 |
| 0.10904 | 1 |
| 0.10905 | 1 |
| 0.10906 | 1 |
| 0.10907 | 1 |
| 0.10908 | 1 |
| 0.10909 | 1 |
| 0.1091 | 1 |
| 0.10911 | 1 |
| 0.10912 | 1 |
| 0.10913 | 1 |
| 0.10914 | 1 |
| 0.10915 | 1 |
| 0.10916 | 1 |
| 0.10917 | 1 |
| 0.10918 | 1 |
| 0.10919 | 1 |
| 0.1092 | 1 |
| 0.10921 | 1 |
| 0.10922 | 1 |
| 0.10923 | 1 |
| 0.10924 | 1 |
| 0.10925 | 1 |
| 0.10926 | 1 |
| 0.10927 | 1 |
| 0.10928 | 1 |
| 0.10929 | 1 |
| 0.1093 | 1 |
| 0.10931 | 1 |
| 0.10932 | 1 |
| 0.10933 | 1 |
| 0.10934 | 1 |
| 0.10935 | 1 |
| 0.10936 | 1 |
| 0.10937 | 1 |
| 0.10938 | 1 |
| 0.10939 | 1 |
| 0.1094 | 1 |
| 0.10941 | 1 |
| 0.10942 | 1 |
| 0.10943 | 1 |
| 0.10944 | 1 |
| 0.10945 | 1 |
| 0.10946 | 1 |
| 0.10947 | 1 |
| 0.10948 | 1 |
| 0.10949 | 1 |
| 0.1095 | 1 |
| 0.10951 | 1 |
| 0.10952 | 1 |
| 0.10953 | 1 |
| 0.10954 | 1 |
| 0.10955 | 1 |
| 0.10956 | 1 |
| 0.10957 | 1 |
| 0.10958 | 1 |
| 0.10959 | 1 |
| 0.1096 | 1 |
| 0.10961 | 1 |
| 0.10962 | 1 |
| 0.10963 | 1 |
| 0.10964 | 1 |
| 0.10965 | 1 |
| 0.10966 | 1 |
| 0.10967 | 1 |
| 0.10968 | 1 |
| 0.10969 | 1 |
| 0.1097 | 1 |
| 0.10971 | 1 |
| 0.10972 | 1 |
| 0.10973 | 1 |
| 0.10974 | 1 |
| 0.10975 | 1 |
| 0.10976 | 1 |
| 0.10977 | 1 |
| 0.10978 | 1 |
| 0.10979 | 1 |
| 0.1098 | 1 |
| 0.10981 | 1 |
| 0.10982 | 1 |
| 0.10983 | 1 |
| 0.10984 | 1 |
| 0.10985 | 1 |
| 0.10986 | 1 |
| 0.10987 | 1 |
| 0.10988 | 1 |
| 0.10989 | 1 |
| 0.1099 | 1 |
| 0.10991 | 1 |
| 0.10992 | 1 |
| 0.10993 | 1 |
| 0.10994 | 1 |
| 0.10995 | 1 |
| 0.10996 | 1 |
| 0.10997 | 1 |
| 0.10998 | 1 |
| 0.10999 | 1 |
| 0.11 | 1 |
| 0.11001 | 1 |
| 0.11002 | 1 |
| 0.11003 | 1 |
| 0.11004 | 1 |
| 0.11005 | 1 |
| 0.11006 | 1 |
| 0.11007 | 1 |
| 0.11008 | 1 |
| 0.11009 | 1 |
| 0.1101 | 1 |
| 0.11011 | 1 |
| 0.11012 | 1 |
| 0.11013 | 1 |
| 0.11014 | 1 |
| 0.11015 | 1 |
| 0.11016 | 1 |
| 0.11017 | 1 |
| 0.11018 | 1 |
| 0.11019 | 1 |
| 0.1102 | 1 |
| 0.11021 | 1 |
| 0.11022 | 1 |
| 0.11023 | 1 |
| 0.11024 | 1 |
| 0.11025 | 1 |
| 0.11026 | 1 |
| 0.11027 | 1 |
| 0.11028 | 1 |
| 0.11029 | 1 |
| 0.1103 | 1 |
| 0.11031 | 1 |
| 0.11032 | 1 |
| 0.11033 | 1 |
| 0.11034 | 1 |
| 0.11035 | 1 |
| 0.11036 | 1 |
| 0.11037 | 1 |
| 0.11038 | 1 |
| 0.11039 | 1 |
| 0.1104 | 1 |
| 0.11041 | 1 |
| 0.11042 | 1 |
| 0.11043 | 1 |
| 0.11044 | 1 |
| 0.11045 | 1 |
| 0.11046 | 1 |
| 0.11047 | 1 |
| 0.11048 | 1 |
| 0.11049 | 1 |
| 0.1105 | 1 |
| 0.11051 | 1 |
| 0.11052 | 1 |
| 0.11053 | 1 |
| 0.11054 | 1 |
| 0.11055 | 1 |
| 0.11056 | 1 |
| 0.11057 | 1 |
| 0.11058 | 1 |
| 0.11059 | 1 |
| 0.1106 | 1 |
| 0.11061 | 1 |
| 0.11062 | 1 |
| 0.11063 | 1 |
| 0.11064 | 1 |
| 0.11065 | 1 |
| 0.11066 | 1 |
| 0.11067 | 1 |
| 0.11068 | 1 |
| 0.11069 | 1 |
| 0.1107 | 1 |
| 0.11071 | 1 |
| 0.11072 | 1 |
| 0.11073 | 1 |
| 0.11074 | 1 |
| 0.11075 | 1 |
| 0.11076 | 1 |
| 0.11077 | 1 |
| 0.11078 | 1 |
| 0.11079 | 1 |
| 0.1108 | 1 |
| 0.11081 | 1 |
| 0.11082 | 1 |
| 0.11083 | 1 |
| 0.11084 | 1 |
| 0.11085 | 1 |
| 0.11086 | 1 |
| 0.11087 | 1 |
| 0.11088 | 1 |
| 0.11089 | 1 |
| 0.1109 | 1 |
| 0.11091 | 1 |
| 0.11092 | 1 |
| 0.11093 | 1 |
| 0.11094 | 1 |
| 0.11095 | 1 |
| 0.11096 | 1 |
| 0.11097 | 1 |
| 0.11098 | 1 |
| 0.11099 | 1 |
| 0.111 | 1 |
| 0.11101 | 1 |
| 0.11102 | 1 |
| 0.11103 | 1 |
| 0.11104 | 1 |
| 0.11105 | 1 |
| 0.11106 | 1 |
| 0.11107 | 1 |
| 0.11108 | 1 |
| 0.11109 | 1 |
| 0.1111 | 1 |
| 0.11111 | 1 |
| 0.11112 | 1 |
| 0.11113 | 1 |
| 0.11114 | 1 |
| 0.11115 | 1 |
| 0.11116 | 1 |
| 0.11117 | 1 |
| 0.11118 | 1 |
| 0.11119 | 1 |
| 0.1112 | 1 |
| 0.11121 | 1 |
| 0.11122 | 1 |
| 0.11123 | 1 |
| 0.11124 | 1 |
| 0.11125 | 1 |
| 0.11126 | 1 |
| 0.11127 | 1 |
| 0.11128 | 1 |
| 0.11129 | 1 |
| 0.1113 | 1 |
| 0.11131 | 1 |
| 0.11132 | 1 |
| 0.11133 | 1 |
| 0.11134 | 1 |
| 0.11135 | 1 |
| 0.11136 | 1 |
| 0.11137 | 1 |
| 0.11138 | 1 |
| 0.11139 | 1 |
| 0.1114 | 1 |
| 0.11141 | 1 |
| 0.11142 | 1 |
| 0.11143 | 1 |
| 0.11144 | 1 |
| 0.11145 | 1 |
| 0.11146 | 1 |
| 0.11147 | 1 |
| 0.11148 | 1 |
| 0.11149 | 1 |
| 0.1115 | 1 |
| 0.11151 | 1 |
| 0.11152 | 1 |
| 0.11153 | 1 |
| 0.11154 | 1 |
| 0.11155 | 1 |
| 0.11156 | 1 |
| 0.11157 | 1 |
| 0.11158 | 1 |
| 0.11159 | 1 |
| 0.1116 | 1 |
| 0.11161 | 1 |
| 0.11162 | 1 |
| 0.11163 | 1 |
| 0.11164 | 1 |
| 0.11165 | 1 |
| 0.11166 | 1 |
| 0.11167 | 1 |
| 0.11168 | 1 |
| 0.11169 | 1 |
| 0.1117 | 1 |
| 0.11171 | 1 |
| 0.11172 | 1 |
| 0.11173 | 1 |
| 0.11174 | 1 |
| 0.11175 | 1 |
| 0.11176 | 1 |
| 0.11177 | 1 |
| 0.11178 | 1 |
| 0.11179 | 1 |
| 0.1118 | 1 |
| 0.11181 | 1 |
| 0.11182 | 1 |
| 0.11183 | 1 |
| 0.11184 | 1 |
| 0.11185 | 1 |
| 0.11186 | 1 |
| 0.11187 | 1 |
| 0.11188 | 1 |
| 0.11189 | 1 |
| 0.1119 | 1 |
| 0.11191 | 1 |
| 0.11192 | 1 |
| 0.11193 | 1 |
| 0.11194 | 1 |
| 0.11195 | 1 |
| 0.11196 | 1 |
| 0.11197 | 1 |
| 0.11198 | 1 |
| 0.11199 | 1 |
| 0.112 | 1 |
| 0.11201 | 1 |
| 0.11202 | 1 |
| 0.11203 | 1 |
| 0.11204 | 1 |
| 0.11205 | 1 |
| 0.11206 | 1 |
| 0.11207 | 1 |
| 0.11208 | 1 |
| 0.11209 | 1 |
| 0.1121 | 1 |
| 0.11211 | 1 |
| 0.11212 | 1 |
| 0.11213 | 1 |
| 0.11214 | 1 |
| 0.11215 | 1 |
| 0.11216 | 1 |
| 0.11217 | 1 |
| 0.11218 | 1 |
| 0.11219 | 1 |
| 0.1122 | 1 |
| 0.11221 | 1 |
| 0.11222 | 1 |
| 0.11223 | 1 |
| 0.11224 | 1 |
| 0.11225 | 1 |
| 0.11226 | 1 |
| 0.11227 | 1 |
| 0.11228 | 1 |
| 0.11229 | 1 |
| 0.1123 | 1 |
| 0.11231 | 1 |
| 0.11232 | 1 |
| 0.11233 | 1 |
| 0.11234 | 1 |
| 0.11235 | 1 |
| 0.11236 | 1 |
| 0.11237 | 1 |
| 0.11238 | 1 |
| 0.11239 | 1 |
| 0.1124 | 1 |
| 0.11241 | 1 |
| 0.11242 | 1 |
| 0.11243 | 1 |
| 0.11244 | 1 |
| 0.11245 | 1 |
| 0.11246 | 1 |
| 0.11247 | 1 |
| 0.11248 | 1 |
| 0.11249 | 1 |
| 0.1125 | 1 |
| 0.11251 | 1 |
| 0.11252 | 1 |
| 0.11253 | 1 |
| 0.11254 | 1 |
| 0.11255 | 1 |
| 0.11256 | 1 |
| 0.11257 | 1 |
| 0.11258 | 1 |
| 0.11259 | 1 |
| 0.1126 | 1 |
| 0.11261 | 1 |
| 0.11262 | 1 |
| 0.11263 | 1 |
| 0.11264 | 1 |
| 0.11265 | 1 |
| 0.11266 | 1 |
| 0.11267 | 1 |
| 0.11268 | 1 |
| 0.11269 | 1 |
| 0.1127 | 1 |
| 0.11271 | 1 |
| 0.11272 | 1 |
| 0.11273 | 1 |
| 0.11274 | 1 |
| 0.11275 | 1 |
| 0.11276 | 1 |
| 0.11277 | 1 |
| 0.11278 | 1 |
| 0.11279 | 1 |
| 0.1128 | 1 |
| 0.11281 | 1 |
| 0.11282 | 1 |
| 0.11283 | 1 |
| 0.11284 | 1 |
| 0.11285 | 1 |
| 0.11286 | 1 |
| 0.11287 | 1 |
| 0.11288 | 1 |
| 0.11289 | 1 |
| 0.1129 | 1 |
| 0.11291 | 1 |
| 0.11292 | 1 |
| 0.11293 | 1 |
| 0.11294 | 1 |
| 0.11295 | 1 |
| 0.11296 | 1 |
| 0.11297 | 1 |
| 0.11298 | 1 |
| 0.11299 | 1 |
| 0.113 | 1 |
| 0.11301 | 1 |
| 0.11302 | 1 |
| 0.11303 | 1 |
| 0.11304 | 1 |
| 0.11305 | 1 |
| 0.11306 | 1 |
| 0.11307 | 1 |
| 0.11308 | 1 |
| 0.11309 | 1 |
| 0.1131 | 1 |
| 0.11311 | 1 |
| 0.11312 | 1 |
| 0.11313 | 1 |
| 0.11314 | 1 |
| 0.11315 | 1 |
| 0.11316 | 1 |
| 0.11317 | 1 |
| 0.11318 | 1 |
| 0.11319 | 1 |
| 0.1132 | 1 |
| 0.11321 | 1 |
| 0.11322 | 1 |
| 0.11323 | 1 |
| 0.11324 | 1 |
| 0.11325 | 1 |
| 0.11326 | 1 |
| 0.11327 | 1 |
| 0.11328 | 1 |
| 0.11329 | 1 |
| 0.1133 | 1 |
| 0.11331 | 1 |
| 0.11332 | 1 |
| 0.11333 | 1 |
| 0.11334 | 1 |
| 0.11335 | 1 |
| 0.11336 | 1 |
| 0.11337 | 1 |
| 0.11338 | 1 |
| 0.11339 | 1 |
| 0.1134 | 1 |
| 0.11341 | 1 |
| 0.11342 | 1 |
| 0.11343 | 1 |
| 0.11344 | 1 |
| 0.11345 | 1 |
| 0.11346 | 1 |
| 0.11347 | 1 |
| 0.11348 | 1 |
| 0.11349 | 1 |
| 0.1135 | 1 |
| 0.11351 | 1 |
| 0.11352 | 1 |
| 0.11353 | 1 |
| 0.11354 | 1 |
| 0.11355 | 1 |
| 0.11356 | 1 |
| 0.11357 | 1 |
| 0.11358 | 1 |
| 0.11359 | 1 |
| 0.1136 | 1 |
| 0.11361 | 1 |
| 0.11362 | 1 |
| 0.11363 | 1 |
| 0.11364 | 1 |
| 0.11365 | 1 |
| 0.11366 | 1 |
| 0.11367 | 1 |
| 0.11368 | 1 |
| 0.11369 | 1 |
| 0.1137 | 1 |
| 0.11371 | 1 |
| 0.11372 | 1 |
| 0.11373 | 1 |
| 0.11374 | 1 |
| 0.11375 | 1 |
| 0.11376 | 1 |
| 0.11377 | 1 |
| 0.11378 | 1 |
| 0.11379 | 1 |
| 0.1138 | 1 |
| 0.11381 | 1 |
| 0.11382 | 1 |
| 0.11383 | 1 |
| 0.11384 | 1 |
| 0.11385 | 1 |
| 0.11386 | 1 |
| 0.11387 | 1 |
| 0.11388 | 1 |
| 0.11389 | 1 |
| 0.1139 | 1 |
| 0.11391 | 1 |
| 0.11392 | 1 |
| 0.11393 | 1 |
| 0.11394 | 1 |
| 0.11395 | 1 |
| 0.11396 | 1 |
| 0.11397 | 1 |
| 0.11398 | 1 |
| 0.11399 | 1 |
| 0.114 | 1 |
| 0.11401 | 1 |
| 0.11402 | 1 |
| 0.11403 | 1 |
| 0.11404 | 1 |
| 0.11405 | 1 |
| 0.11406 | 1 |
| 0.11407 | 1 |
| 0.11408 | 1 |
| 0.11409 | 1 |
| 0.1141 | 1 |
| 0.11411 | 1 |
| 0.11412 | 1 |
| 0.11413 | 1 |
| 0.11414 | 1 |
| 0.11415 | 1 |
| 0.11416 | 1 |
| 0.11417 | 1 |
| 0.11418 | 1 |
| 0.11419 | 1 |
| 0.1142 | 1 |
| 0.11421 | 1 |
| 0.11422 | 1 |
| 0.11423 | 1 |
| 0.11424 | 1 |
| 0.11425 | 1 |
| 0.11426 | 1 |
| 0.11427 | 1 |
| 0.11428 | 1 |
| 0.11429 | 1 |
| 0.1143 | 1 |
| 0.11431 | 1 |
| 0.11432 | 1 |
| 0.11433 | 1 |
| 0.11434 | 1 |
| 0.11435 | 1 |
| 0.11436 | 1 |
| 0.11437 | 1 |
| 0.11438 | 1 |
| 0.11439 | 1 |
| 0.1144 | 1 |
| 0.11441 | 1 |
| 0.11442 | 1 |
| 0.11443 | 1 |
| 0.11444 | 1 |
| 0.11445 | 1 |
| 0.11446 | 1 |
| 0.11447 | 1 |
| 0.11448 | 1 |
| 0.11449 | 1 |
| 0.1145 | 1 |
| 0.11451 | 1 |
| 0.11452 | 1 |
| 0.11453 | 1 |
| 0.11454 | 1 |
| 0.11455 | 1 |
| 0.11456 | 1 |
| 0.11457 | 1 |
| 0.11458 | 1 |
| 0.11459 | 1 |
| 0.1146 | 1 |
| 0.11461 | 1 |
| 0.11462 | 1 |
| 0.11463 | 1 |
| 0.11464 | 1 |
| 0.11465 | 1 |
| 0.11466 | 1 |
| 0.11467 | 1 |
| 0.11468 | 1 |
| 0.11469 | 1 |
| 0.1147 | 1 |
| 0.11471 | 1 |
| 0.11472 | 1 |
| 0.11473 | 1 |
| 0.11474 | 1 |
| 0.11475 | 1 |
| 0.11476 | 1 |
| 0.11477 | 1 |
| 0.11478 | 1 |
| 0.11479 | 1 |
| 0.1148 | 1 |
| 0.11481 | 1 |
| 0.11482 | 1 |
| 0.11483 | 1 |
| 0.11484 | 1 |
| 0.11485 | 1 |
| 0.11486 | 1 |
| 0.11487 | 1 |
| 0.11488 | 1 |
| 0.11489 | 1 |
| 0.1149 | 1 |
| 0.11491 | 1 |
| 0.11492 | 1 |
| 0.11493 | 1 |
| 0.11494 | 1 |
| 0.11495 | 1 |
| 0.11496 | 1 |
| 0.11497 | 1 |
| 0.11498 | 1 |
| 0.11499 | 1 |
| 0.115 | 1 |
| 0.11501 | 1 |
| 0.11502 | 1 |
| 0.11503 | 1 |
| 0.11504 | 1 |
| 0.11505 | 1 |
| 0.11506 | 1 |
| 0.11507 | 1 |
| 0.11508 | 1 |
| 0.11509 | 1 |
| 0.1151 | 1 |
| 0.11511 | 1 |
| 0.11512 | 1 |
| 0.11513 | 1 |
| 0.11514 | 1 |
| 0.11515 | 1 |
| 0.11516 | 1 |
| 0.11517 | 1 |
| 0.11518 | 1 |
| 0.11519 | 1 |
| 0.1152 | 1 |
| 0.11521 | 1 |
| 0.11522 | 1 |
| 0.11523 | 1 |
| 0.11524 | 1 |
| 0.11525 | 1 |
| 0.11526 | 1 |
| 0.11527 | 1 |
| 0.11528 | 1 |
| 0.11529 | 1 |
| 0.1153 | 1 |
| 0.11531 | 1 |
| 0.11532 | 1 |
| 0.11533 | 1 |
| 0.11534 | 1 |
| 0.11535 | 1 |
| 0.11536 | 1 |
| 0.11537 | 1 |
| 0.11538 | 1 |
| 0.11539 | 1 |
| 0.1154 | 1 |
| 0.11541 | 1 |
| 0.11542 | 1 |
| 0.11543 | 1 |
| 0.11544 | 1 |
| 0.11545 | 1 |
| 0.11546 | 1 |
| 0.11547 | 1 |
| 0.11548 | 1 |
| 0.11549 | 1 |
| 0.1155 | 1 |
| 0.11551 | 1 |
| 0.11552 | 1 |
| 0.11553 | 1 |
| 0.11554 | 1 |
| 0.11555 | 1 |
| 0.11556 | 1 |
| 0.11557 | 1 |
| 0.11558 | 1 |
| 0.11559 | 1 |
| 0.1156 | 1 |
| 0.11561 | 1 |
| 0.11562 | 1 |
| 0.11563 | 1 |
| 0.11564 | 1 |
| 0.11565 | 1 |
| 0.11566 | 1 |
| 0.11567 | 1 |
| 0.11568 | 1 |
| 0.11569 | 1 |
| 0.1157 | 1 |
| 0.11571 | 1 |
| 0.11572 | 1 |
| 0.11573 | 1 |
| 0.11574 | 1 |
| 0.11575 | 1 |
| 0.11576 | 1 |
| 0.11577 | 1 |
| 0.11578 | 1 |
| 0.11579 | 1 |
| 0.1158 | 1 |
| 0.11581 | 1 |
| 0.11582 | 1 |
| 0.11583 | 1 |
| 0.11584 | 1 |
| 0.11585 | 1 |
| 0.11586 | 1 |
| 0.11587 | 1 |
| 0.11588 | 1 |
| 0.11589 | 1 |
| 0.1159 | 1 |
| 0.11591 | 1 |
| 0.11592 | 1 |
| 0.11593 | 0.999 |
| 0.11594 | 0.999 |
| 0.11595 | 0.999 |
| 0.11596 | 0.999 |
| 0.11597 | 0.999 |
| 0.11598 | 0.999 |
| 0.11599 | 0.999 |
| 0.116 | 0.999 |
| 0.11601 | 0.999 |
| 0.11602 | 0.999 |
| 0.11603 | 0.999 |
| 0.11604 | 0.999 |
| 0.11605 | 0.999 |
| 0.11606 | 0.999 |
| 0.11607 | 0.999 |
| 0.11608 | 0.999 |
| 0.11609 | 0.999 |
| 0.1161 | 0.999 |
| 0.11611 | 0.999 |
| 0.11612 | 0.999 |
| 0.11613 | 0.999 |
| 0.11614 | 0.999 |
| 0.11615 | 0.999 |
| 0.11616 | 0.999 |
| 0.11617 | 0.999 |
| 0.11618 | 0.999 |
| 0.11619 | 0.999 |
| 0.1162 | 0.999 |
| 0.11621 | 0.999 |
| 0.11622 | 0.999 |
| 0.11623 | 0.999 |
| 0.11624 | 0.999 |
| 0.11625 | 0.999 |
| 0.11626 | 0.999 |
| 0.11627 | 0.999 |
| 0.11628 | 0.999 |
| 0.11629 | 0.999 |
| 0.1163 | 0.999 |
| 0.11631 | 0.999 |
| 0.11632 | 0.999 |
| 0.11633 | 0.999 |
| 0.11634 | 0.999 |
| 0.11635 | 0.999 |
| 0.11636 | 0.999 |
| 0.11637 | 0.999 |
| 0.11638 | 0.999 |
| 0.11639 | 0.999 |
| 0.1164 | 0.999 |
| 0.11641 | 0.999 |
| 0.11642 | 0.999 |
| 0.11643 | 0.999 |
| 0.11644 | 0.999 |
| 0.11645 | 0.999 |
| 0.11646 | 0.999 |
| 0.11647 | 0.999 |
| 0.11648 | 0.999 |
| 0.11649 | 0.999 |
| 0.1165 | 0.999 |
| 0.11651 | 0.999 |
| 0.11652 | 0.999 |
| 0.11653 | 0.999 |
| 0.11654 | 0.999 |
| 0.11655 | 0.999 |
| 0.11656 | 0.999 |
| 0.11657 | 0.999 |
| 0.11658 | 0.999 |
| 0.11659 | 0.999 |
| 0.1166 | 0.999 |
| 0.11661 | 0.999 |
| 0.11662 | 0.999 |
| 0.11663 | 0.999 |
| 0.11664 | 0.999 |
| 0.11665 | 0.999 |
| 0.11666 | 0.999 |
| 0.11667 | 0.999 |
| 0.11668 | 0.999 |
| 0.11669 | 0.999 |
| 0.1167 | 0.999 |
| 0.11671 | 0.999 |
| 0.11672 | 0.999 |
| 0.11673 | 0.999 |
| 0.11674 | 0.999 |
| 0.11675 | 0.999 |
| 0.11676 | 0.999 |
| 0.11677 | 0.999 |
| 0.11678 | 0.999 |
| 0.11679 | 0.999 |
| 0.1168 | 0.999 |
| 0.11681 | 0.999 |
| 0.11682 | 0.999 |
| 0.11683 | 0.999 |
| 0.11684 | 0.999 |
| 0.11685 | 0.999 |
| 0.11686 | 0.999 |
| 0.11687 | 0.999 |
| 0.11688 | 0.999 |
| 0.11689 | 0.999 |
| 0.1169 | 0.999 |
| 0.11691 | 0.999 |
| 0.11692 | 0.999 |
| 0.11693 | 0.999 |
| 0.11694 | 0.999 |
| 0.11695 | 0.999 |
| 0.11696 | 0.999 |
| 0.11697 | 0.999 |
| 0.11698 | 0.999 |
| 0.11699 | 0.999 |
| 0.117 | 0.999 |
| 0.11701 | 0.999 |
| 0.11702 | 0.999 |
| 0.11703 | 0.999 |
| 0.11704 | 0.999 |
| 0.11705 | 0.999 |
| 0.11706 | 0.999 |
| 0.11707 | 0.999 |
| 0.11708 | 0.999 |
| 0.11709 | 0.999 |
| 0.1171 | 0.999 |
| 0.11711 | 0.999 |
| 0.11712 | 0.999 |
| 0.11713 | 0.999 |
| 0.11714 | 0.999 |
| 0.11715 | 0.999 |
| 0.11716 | 0.999 |
| 0.11717 | 0.999 |
| 0.11718 | 0.999 |
| 0.11719 | 0.999 |
| 0.1172 | 0.999 |
| 0.11721 | 0.999 |
| 0.11722 | 0.999 |
| 0.11723 | 0.999 |
| 0.11724 | 0.999 |
| 0.11725 | 0.999 |
| 0.11726 | 0.999 |
| 0.11727 | 0.999 |
| 0.11728 | 0.999 |
| 0.11729 | 0.999 |
| 0.1173 | 0.999 |
| 0.11731 | 0.999 |
| 0.11732 | 0.999 |
| 0.11733 | 0.999 |
| 0.11734 | 0.999 |
| 0.11735 | 0.999 |
| 0.11736 | 0.999 |
| 0.11737 | 0.999 |
| 0.11738 | 0.999 |
| 0.11739 | 0.999 |
| 0.1174 | 0.999 |
| 0.11741 | 0.999 |
| 0.11742 | 0.999 |
| 0.11743 | 0.999 |
| 0.11744 | 0.999 |
| 0.11745 | 0.999 |
| 0.11746 | 0.999 |
| 0.11747 | 0.999 |
| 0.11748 | 0.999 |
| 0.11749 | 0.999 |
| 0.1175 | 0.999 |
| 0.11751 | 0.999 |
| 0.11752 | 0.999 |
| 0.11753 | 0.999 |
| 0.11754 | 0.999 |
| 0.11755 | 0.999 |
| 0.11756 | 0.999 |
| 0.11757 | 0.999 |
| 0.11758 | 0.999 |
| 0.11759 | 0.999 |
| 0.1176 | 0.999 |
| 0.11761 | 0.999 |
| 0.11762 | 0.999 |
| 0.11763 | 0.999 |
| 0.11764 | 0.999 |
| 0.11765 | 0.999 |
| 0.11766 | 0.999 |
| 0.11767 | 0.999 |
| 0.11768 | 0.999 |
| 0.11769 | 0.999 |
| 0.1177 | 0.999 |
| 0.11771 | 0.999 |
| 0.11772 | 0.999 |
| 0.11773 | 0.999 |
| 0.11774 | 0.999 |
| 0.11775 | 0.999 |
| 0.11776 | 0.999 |
| 0.11777 | 0.999 |
| 0.11778 | 0.999 |
| 0.11779 | 0.999 |
| 0.1178 | 0.999 |
| 0.11781 | 0.999 |
| 0.11782 | 0.999 |
| 0.11783 | 0.999 |
| 0.11784 | 0.999 |
| 0.11785 | 0.999 |
| 0.11786 | 0.999 |
| 0.11787 | 0.999 |
| 0.11788 | 0.999 |
| 0.11789 | 0.999 |
| 0.1179 | 0.999 |
| 0.11791 | 0.999 |
| 0.11792 | 0.999 |
| 0.11793 | 0.999 |
| 0.11794 | 0.999 |
| 0.11795 | 0.999 |
| 0.11796 | 0.999 |
| 0.11797 | 0.999 |
| 0.11798 | 0.999 |
| 0.11799 | 0.999 |
| 0.118 | 0.999 |
| 0.11801 | 0.999 |
| 0.11802 | 0.999 |
| 0.11803 | 0.999 |
| 0.11804 | 0.999 |
| 0.11805 | 0.999 |
| 0.11806 | 0.999 |
| 0.11807 | 0.999 |
| 0.11808 | 0.999 |
| 0.11809 | 0.999 |
| 0.1181 | 0.999 |
| 0.11811 | 0.999 |
| 0.11812 | 0.999 |
| 0.11813 | 0.999 |
| 0.11814 | 0.999 |
| 0.11815 | 0.999 |
| 0.11816 | 0.999 |
| 0.11817 | 0.999 |
| 0.11818 | 0.999 |
| 0.11819 | 0.999 |
| 0.1182 | 0.999 |
| 0.11821 | 0.999 |
| 0.11822 | 0.999 |
| 0.11823 | 0.999 |
| 0.11824 | 0.999 |
| 0.11825 | 0.999 |
| 0.11826 | 0.999 |
| 0.11827 | 0.999 |
| 0.11828 | 0.999 |
| 0.11829 | 0.999 |
| 0.1183 | 0.999 |
| 0.11831 | 0.999 |
| 0.11832 | 0.999 |
| 0.11833 | 0.999 |
| 0.11834 | 0.999 |
| 0.11835 | 0.999 |
| 0.11836 | 0.999 |
| 0.11837 | 0.999 |
| 0.11838 | 0.999 |
| 0.11839 | 0.999 |
| 0.1184 | 0.999 |
| 0.11841 | 0.999 |
| 0.11842 | 0.999 |
| 0.11843 | 0.999 |
| 0.11844 | 0.999 |
| 0.11845 | 0.999 |
| 0.11846 | 0.999 |
| 0.11847 | 0.999 |
| 0.11848 | 0.999 |
| 0.11849 | 0.999 |
| 0.1185 | 0.999 |
| 0.11851 | 0.999 |
| 0.11852 | 0.999 |
| 0.11853 | 0.999 |
| 0.11854 | 0.999 |
| 0.11855 | 0.999 |
| 0.11856 | 0.999 |
| 0.11857 | 0.999 |
| 0.11858 | 0.999 |
| 0.11859 | 0.999 |
| 0.1186 | 0.999 |
| 0.11861 | 0.999 |
| 0.11862 | 0.999 |
| 0.11863 | 0.999 |
| 0.11864 | 0.999 |
| 0.11865 | 0.999 |
| 0.11866 | 0.999 |
| 0.11867 | 0.999 |
| 0.11868 | 0.999 |
| 0.11869 | 0.999 |
| 0.1187 | 0.999 |
| 0.11871 | 0.999 |
| 0.11872 | 0.999 |
| 0.11873 | 0.999 |
| 0.11874 | 0.999 |
| 0.11875 | 0.999 |
| 0.11876 | 0.999 |
| 0.11877 | 0.999 |
| 0.11878 | 0.999 |
| 0.11879 | 0.999 |
| 0.1188 | 0.999 |
| 0.11881 | 0.999 |
| 0.11882 | 0.999 |
| 0.11883 | 0.999 |
| 0.11884 | 0.999 |
| 0.11885 | 0.999 |
| 0.11886 | 0.999 |
| 0.11887 | 0.999 |
| 0.11888 | 0.999 |
| 0.11889 | 0.999 |
| 0.1189 | 0.999 |
| 0.11891 | 0.999 |
| 0.11892 | 0.999 |
| 0.11893 | 0.999 |
| 0.11894 | 0.999 |
| 0.11895 | 0.999 |
| 0.11896 | 0.999 |
| 0.11897 | 0.999 |
| 0.11898 | 0.999 |
| 0.11899 | 0.999 |
| 0.119 | 0.999 |
| 0.11901 | 0.999 |
| 0.11902 | 0.999 |
| 0.11903 | 0.999 |
| 0.11904 | 0.999 |
| 0.11905 | 0.999 |
| 0.11906 | 0.999 |
| 0.11907 | 0.999 |
| 0.11908 | 0.999 |
| 0.11909 | 0.999 |
| 0.1191 | 0.999 |
| 0.11911 | 0.999 |
| 0.11912 | 0.999 |
| 0.11913 | 0.999 |
| 0.11914 | 0.999 |
| 0.11915 | 0.999 |
| 0.11916 | 0.999 |
| 0.11917 | 0.999 |
| 0.11918 | 0.999 |
| 0.11919 | 0.999 |
| 0.1192 | 0.999 |
| 0.11921 | 0.999 |
| 0.11922 | 0.999 |
| 0.11923 | 0.999 |
| 0.11924 | 0.999 |
| 0.11925 | 1 |
| 0.11926 | 1 |
| 0.11927 | 1 |
| 0.11928 | 1 |
| 0.11929 | 1 |
| 0.1193 | 1 |
| 0.11931 | 1 |
| 0.11932 | 1 |
| 0.11933 | 1 |
| 0.11934 | 1 |
| 0.11935 | 1 |
| 0.11936 | 1 |
| 0.11937 | 1 |
| 0.11938 | 1 |
| 0.11939 | 1 |
| 0.1194 | 1 |
| 0.11941 | 1 |
| 0.11942 | 1 |
| 0.11943 | 1 |
| 0.11944 | 1 |
| 0.11945 | 1 |
| 0.11946 | 1 |
| 0.11947 | 1 |
| 0.11948 | 1 |
| 0.11949 | 1 |
| 0.1195 | 1 |
| 0.11951 | 1 |
| 0.11952 | 1 |
| 0.11953 | 1 |
| 0.11954 | 1 |
| 0.11955 | 1 |
| 0.11956 | 1 |
| 0.11957 | 1 |
| 0.11958 | 1 |
| 0.11959 | 1 |
| 0.1196 | 1 |
| 0.11961 | 1 |
| 0.11962 | 1 |
| 0.11963 | 1 |
| 0.11964 | 1 |
| 0.11965 | 1 |
| 0.11966 | 1 |
| 0.11967 | 1 |
| 0.11968 | 1 |
| 0.11969 | 1 |
| 0.1197 | 1 |
| 0.11971 | 1 |
| 0.11972 | 1 |
| 0.11973 | 1 |
| 0.11974 | 1 |
| 0.11975 | 1 |
| 0.11976 | 1 |
| 0.11977 | 1 |
| 0.11978 | 1 |
| 0.11979 | 1 |
| 0.1198 | 1 |
| 0.11981 | 1 |
| 0.11982 | 1 |
| 0.11983 | 1 |
| 0.11984 | 1 |
| 0.11985 | 1 |
| 0.11986 | 1 |
| 0.11987 | 1 |
| 0.11988 | 1 |
| 0.11989 | 1 |
| 0.1199 | 1 |
| 0.11991 | 1 |
| 0.11992 | 1 |
| 0.11993 | 1 |
| 0.11994 | 1 |
| 0.11995 | 1 |
| 0.11996 | 1 |
| 0.11997 | 1 |
| 0.11998 | 1 |
| 0.11999 | 1 |
| 0.12 | 1 |
| 0.12001 | 1 |
| 0.12002 | 1 |
| 0.12003 | 1 |
| 0.12004 | 1 |
| 0.12005 | 1 |
| 0.12006 | 1 |
| 0.12007 | 1 |
| 0.12008 | 1 |
| 0.12009 | 1 |
| 0.1201 | 1 |
| 0.12011 | 1 |
| 0.12012 | 1 |
| 0.12013 | 1 |
| 0.12014 | 1 |
| 0.12015 | 1 |
| 0.12016 | 1 |
| 0.12017 | 1 |
| 0.12018 | 1 |
| 0.12019 | 1 |
| 0.1202 | 1 |
| 0.12021 | 1 |
| 0.12022 | 1 |
| 0.12023 | 1 |
| 0.12024 | 1 |
| 0.12025 | 1 |
| 0.12026 | 1 |
| 0.12027 | 1 |
| 0.12028 | 1 |
| 0.12029 | 1 |
| 0.1203 | 1 |
| 0.12031 | 1 |
| 0.12032 | 1 |
| 0.12033 | 1 |
| 0.12034 | 1 |
| 0.12035 | 1 |
| 0.12036 | 1 |
| 0.12037 | 1 |
| 0.12038 | 1 |
| 0.12039 | 1 |
| 0.1204 | 1 |
| 0.12041 | 1 |
| 0.12042 | 1 |
| 0.12043 | 1 |
| 0.12044 | 1 |
| 0.12045 | 1 |
| 0.12046 | 1 |
| 0.12047 | 1 |
| 0.12048 | 1 |
| 0.12049 | 1 |
| 0.1205 | 1 |
| 0.12051 | 1 |
| 0.12052 | 1 |
| 0.12053 | 1 |
| 0.12054 | 1 |
| 0.12055 | 1 |
| 0.12056 | 1 |
| 0.12057 | 1 |
| 0.12058 | 1 |
| 0.12059 | 1 |
| 0.1206 | 1 |
| 0.12061 | 1 |
| 0.12062 | 1 |
| 0.12063 | 1 |
| 0.12064 | 1 |
| 0.12065 | 1 |
| 0.12066 | 1 |
| 0.12067 | 1 |
| 0.12068 | 1 |
| 0.12069 | 1 |
| 0.1207 | 1 |
| 0.12071 | 1 |
| 0.12072 | 1 |
| 0.12073 | 1 |
| 0.12074 | 1 |
| 0.12075 | 1 |
| 0.12076 | 1 |
| 0.12077 | 1 |
| 0.12078 | 1 |
| 0.12079 | 1 |
| 0.1208 | 1 |
| 0.12081 | 1 |
| 0.12082 | 1 |
| 0.12083 | 1 |
| 0.12084 | 1 |
| 0.12085 | 1 |
| 0.12086 | 1 |
| 0.12087 | 1 |
| 0.12088 | 1 |
| 0.12089 | 1 |
| 0.1209 | 1 |
| 0.12091 | 1 |
| 0.12092 | 1 |
| 0.12093 | 1 |
| 0.12094 | 1 |
| 0.12095 | 1 |
| 0.12096 | 1 |
| 0.12097 | 1 |
| 0.12098 | 1 |
| 0.12099 | 1 |
| 0.121 | 1 |
| 0.12101 | 1 |
| 0.12102 | 1 |
| 0.12103 | 1 |
| 0.12104 | 1 |
| 0.12105 | 1 |
| 0.12106 | 1 |
| 0.12107 | 1 |
| 0.12108 | 1 |
| 0.12109 | 1 |
| 0.1211 | 1 |
| 0.12111 | 1 |
| 0.12112 | 1 |
| 0.12113 | 1 |
| 0.12114 | 1 |
| 0.12115 | 1 |
| 0.12116 | 1 |
| 0.12117 | 1 |
| 0.12118 | 1 |
| 0.12119 | 1 |
| 0.1212 | 1 |
| 0.12121 | 1 |
| 0.12122 | 1 |
| 0.12123 | 1 |
| 0.12124 | 1 |
| 0.12125 | 1 |
| 0.12126 | 1 |
| 0.12127 | 1 |
| 0.12128 | 1 |
| 0.12129 | 1 |
| 0.1213 | 1 |
| 0.12131 | 1 |
| 0.12132 | 1 |
| 0.12133 | 1 |
| 0.12134 | 1 |
| 0.12135 | 1 |
| 0.12136 | 1 |
| 0.12137 | 1 |
| 0.12138 | 1 |
| 0.12139 | 1 |
| 0.1214 | 1 |
| 0.12141 | 1 |
| 0.12142 | 1 |
| 0.12143 | 1 |
| 0.12144 | 1 |
| 0.12145 | 1 |
| 0.12146 | 1 |
| 0.12147 | 1 |
| 0.12148 | 1 |
| 0.12149 | 1 |
| 0.1215 | 1 |
| 0.12151 | 1 |
| 0.12152 | 1 |
| 0.12153 | 1 |
| 0.12154 | 1 |
| 0.12155 | 1 |
| 0.12156 | 1 |
| 0.12157 | 1 |
| 0.12158 | 1 |
| 0.12159 | 1 |
| 0.1216 | 1 |
| 0.12161 | 1 |
| 0.12162 | 1 |
| 0.12163 | 1 |
| 0.12164 | 1 |
| 0.12165 | 1 |
| 0.12166 | 1 |
| 0.12167 | 1 |
| 0.12168 | 1 |
| 0.12169 | 1 |
| 0.1217 | 1 |
| 0.12171 | 1 |
| 0.12172 | 1 |
| 0.12173 | 1 |
| 0.12174 | 1 |
| 0.12175 | 1 |
| 0.12176 | 1 |
| 0.12177 | 1 |
| 0.12178 | 1 |
| 0.12179 | 1 |
| 0.1218 | 1 |
| 0.12181 | 1 |
| 0.12182 | 1 |
| 0.12183 | 1 |
| 0.12184 | 1 |
| 0.12185 | 1 |
| 0.12186 | 1 |
| 0.12187 | 1 |
| 0.12188 | 1 |
| 0.12189 | 1 |
| 0.1219 | 1 |
| 0.12191 | 1 |
| 0.12192 | 1 |
| 0.12193 | 1 |
| 0.12194 | 1 |
| 0.12195 | 1 |
| 0.12196 | 1 |
| 0.12197 | 1 |
| 0.12198 | 1 |
| 0.12199 | 1 |
| 0.122 | 1 |
| 0.12201 | 1 |
| 0.12202 | 1 |
| 0.12203 | 1 |
| 0.12204 | 1 |
| 0.12205 | 1 |
| 0.12206 | 1 |
| 0.12207 | 1 |
| 0.12208 | 1 |
| 0.12209 | 1 |
| 0.1221 | 1 |
| 0.12211 | 1 |
| 0.12212 | 1 |
| 0.12213 | 1 |
| 0.12214 | 1 |
| 0.12215 | 1 |
| 0.12216 | 1 |
| 0.12217 | 1 |
| 0.12218 | 1 |
| 0.12219 | 1 |
| 0.1222 | 1 |
| 0.12221 | 1 |
| 0.12222 | 1 |
| 0.12223 | 1 |
| 0.12224 | 1 |
| 0.12225 | 1 |
| 0.12226 | 1 |
| 0.12227 | 1 |
| 0.12228 | 1 |
| 0.12229 | 1 |
| 0.1223 | 1 |
| 0.12231 | 1 |
| 0.12232 | 1 |
| 0.12233 | 1 |
| 0.12234 | 1 |
| 0.12235 | 1 |
| 0.12236 | 1 |
| 0.12237 | 1 |
| 0.12238 | 1 |
| 0.12239 | 1 |
| 0.1224 | 1 |
| 0.12241 | 1 |
| 0.12242 | 1 |
| 0.12243 | 1 |
| 0.12244 | 1 |
| 0.12245 | 1 |
| 0.12246 | 1 |
| 0.12247 | 1 |
| 0.12248 | 1 |
| 0.12249 | 1 |
| 0.1225 | 1 |
| 0.12251 | 1 |
| 0.12252 | 1 |
| 0.12253 | 1 |
| 0.12254 | 1 |
| 0.12255 | 1 |
| 0.12256 | 1 |
| 0.12257 | 1 |
| 0.12258 | 1 |
| 0.12259 | 1 |
| 0.1226 | 1 |
| 0.12261 | 1 |
| 0.12262 | 1 |
| 0.12263 | 1 |
| 0.12264 | 1 |
| 0.12265 | 1 |
| 0.12266 | 1 |
| 0.12267 | 1 |
| 0.12268 | 1 |
| 0.12269 | 1 |
| 0.1227 | 1 |
| 0.12271 | 1 |
| 0.12272 | 1 |
| 0.12273 | 1 |
| 0.12274 | 1 |
| 0.12275 | 1 |
| 0.12276 | 1 |
| 0.12277 | 1 |
| 0.12278 | 1 |
| 0.12279 | 1 |
| 0.1228 | 1 |
| 0.12281 | 1 |
| 0.12282 | 1 |
| 0.12283 | 1 |
| 0.12284 | 1 |
| 0.12285 | 1 |
| 0.12286 | 1 |
| 0.12287 | 1 |
| 0.12288 | 1 |
| 0.12289 | 1 |
| 0.1229 | 1 |
| 0.12291 | 1 |
| 0.12292 | 1 |
| 0.12293 | 1 |
| 0.12294 | 1 |
| 0.12295 | 1 |
| 0.12296 | 1 |
| 0.12297 | 1 |
| 0.12298 | 1 |
| 0.12299 | 1 |
| 0.123 | 1 |
| 0.12301 | 1 |
| 0.12302 | 1 |
| 0.12303 | 1 |
| 0.12304 | 1 |
| 0.12305 | 1 |
| 0.12306 | 1 |
| 0.12307 | 1 |
| 0.12308 | 1 |
| 0.12309 | 1 |
| 0.1231 | 1 |
| 0.12311 | 1 |
| 0.12312 | 1 |
| 0.12313 | 1 |
| 0.12314 | 1 |
| 0.12315 | 1 |
| 0.12316 | 1 |
| 0.12317 | 1 |
| 0.12318 | 1 |
| 0.12319 | 1 |
| 0.1232 | 1 |
| 0.12321 | 1 |
| 0.12322 | 1 |
| 0.12323 | 1 |
| 0.12324 | 1 |
| 0.12325 | 1 |
| 0.12326 | 1 |
| 0.12327 | 1 |
| 0.12328 | 1 |
| 0.12329 | 1 |
| 0.1233 | 1 |
| 0.12331 | 1 |
| 0.12332 | 1 |
| 0.12333 | 1 |
| 0.12334 | 1 |
| 0.12335 | 1 |
| 0.12336 | 1 |
| 0.12337 | 1 |
| 0.12338 | 1 |
| 0.12339 | 1 |
| 0.1234 | 1 |
| 0.12341 | 1 |
| 0.12342 | 1 |
| 0.12343 | 1 |
| 0.12344 | 1 |
| 0.12345 | 1 |
| 0.12346 | 1 |
| 0.12347 | 1 |
| 0.12348 | 1 |
| 0.12349 | 1 |
| 0.1235 | 1 |
| 0.12351 | 1 |
| 0.12352 | 1 |
| 0.12353 | 1 |
| 0.12354 | 1 |
| 0.12355 | 1 |
| 0.12356 | 1 |
| 0.12357 | 1 |
| 0.12358 | 1 |
| 0.12359 | 1 |
| 0.1236 | 1 |
| 0.12361 | 1 |
| 0.12362 | 1 |
| 0.12363 | 1 |
| 0.12364 | 1 |
| 0.12365 | 1 |
| 0.12366 | 1 |
| 0.12367 | 1 |
| 0.12368 | 1 |
| 0.12369 | 1 |
| 0.1237 | 1 |
| 0.12371 | 1 |
| 0.12372 | 1 |
| 0.12373 | 1 |
| 0.12374 | 1 |
| 0.12375 | 1 |
| 0.12376 | 1 |
| 0.12377 | 1 |
| 0.12378 | 1 |
| 0.12379 | 1 |
| 0.1238 | 1 |
| 0.12381 | 1 |
| 0.12382 | 1 |
| 0.12383 | 1 |
| 0.12384 | 1 |
| 0.12385 | 1 |
| 0.12386 | 1 |
| 0.12387 | 1 |
| 0.12388 | 1 |
| 0.12389 | 1 |
| 0.1239 | 1 |
| 0.12391 | 1 |
| 0.12392 | 1 |
| 0.12393 | 1 |
| 0.12394 | 1 |
| 0.12395 | 1 |
| 0.12396 | 1 |
| 0.12397 | 1 |
| 0.12398 | 1 |
| 0.12399 | 1 |
| 0.124 | 1 |
| 0.12401 | 1 |
| 0.12402 | 1 |
| 0.12403 | 1 |
| 0.12404 | 1 |
| 0.12405 | 1 |
| 0.12406 | 1 |
| 0.12407 | 1 |
| 0.12408 | 1 |
| 0.12409 | 1 |
| 0.1241 | 1 |
| 0.12411 | 1 |
| 0.12412 | 1 |
| 0.12413 | 1 |
| 0.12414 | 1 |
| 0.12415 | 1 |
| 0.12416 | 1 |
| 0.12417 | 1 |
| 0.12418 | 1 |
| 0.12419 | 1 |
| 0.1242 | 1 |
| 0.12421 | 1 |
| 0.12422 | 1 |
| 0.12423 | 1 |
| 0.12424 | 1 |
| 0.12425 | 1 |
| 0.12426 | 1 |
| 0.12427 | 1 |
| 0.12428 | 1 |
| 0.12429 | 1 |
| 0.1243 | 1 |
| 0.12431 | 1 |
| 0.12432 | 1 |
| 0.12433 | 1 |
| 0.12434 | 1 |
| 0.12435 | 1 |
| 0.12436 | 1 |
| 0.12437 | 1 |
| 0.12438 | 1 |
| 0.12439 | 1 |
| 0.1244 | 1 |
| 0.12441 | 1 |
| 0.12442 | 1 |
| 0.12443 | 1 |
| 0.12444 | 1 |
| 0.12445 | 1 |
| 0.12446 | 1 |
| 0.12447 | 1 |
| 0.12448 | 1 |
| 0.12449 | 1 |
| 0.1245 | 1 |
| 0.12451 | 1 |
| 0.12452 | 1 |
| 0.12453 | 1 |
| 0.12454 | 1 |
| 0.12455 | 1 |
| 0.12456 | 1 |
| 0.12457 | 1 |
| 0.12458 | 1 |
| 0.12459 | 1 |
| 0.1246 | 1 |
| 0.12461 | 1 |
| 0.12462 | 1 |
| 0.12463 | 1 |
| 0.12464 | 1 |
| 0.12465 | 1 |
| 0.12466 | 1 |
| 0.12467 | 1 |
| 0.12468 | 1 |
| 0.12469 | 1 |
| 0.1247 | 1 |
| 0.12471 | 1 |
| 0.12472 | 1 |
| 0.12473 | 1 |
| 0.12474 | 1 |
| 0.12475 | 1 |
| 0.12476 | 1 |
| 0.12477 | 1 |
| 0.12478 | 1 |
| 0.12479 | 1 |
| 0.1248 | 1 |
| 0.12481 | 1 |
| 0.12482 | 1 |
| 0.12483 | 1 |
| 0.12484 | 1 |
| 0.12485 | 1 |
| 0.12486 | 1 |
| 0.12487 | 1 |
| 0.12488 | 1 |
| 0.12489 | 1 |
| 0.1249 | 1 |
| 0.12491 | 1 |
| 0.12492 | 1 |
| 0.12493 | 1 |
| 0.12494 | 1 |
| 0.12495 | 1 |
| 0.12496 | 1 |
| 0.12497 | 1 |
| 0.12498 | 1 |
| 0.12499 | 1 |
| 0.125 | 1 |
| 0.12501 | 1 |
| 0.12502 | 1 |
| 0.12503 | 1 |
| 0.12504 | 1 |
| 0.12505 | 1 |
| 0.12506 | 1 |
| 0.12507 | 1 |
| 0.12508 | 1 |
| 0.12509 | 1 |
| 0.1251 | 1 |
| 0.12511 | 1 |
| 0.12512 | 1 |
| 0.12513 | 1 |
| 0.12514 | 1 |
| 0.12515 | 1 |
| 0.12516 | 1 |
| 0.12517 | 1 |
| 0.12518 | 1 |
| 0.12519 | 1 |
| 0.1252 | 1 |
| 0.12521 | 1 |
| 0.12522 | 1 |
| 0.12523 | 1 |
| 0.12524 | 1 |
| 0.12525 | 1 |
| 0.12526 | 1 |
| 0.12527 | 1 |
| 0.12528 | 1 |
| 0.12529 | 1 |
| 0.1253 | 1 |
| 0.12531 | 1 |
| 0.12532 | 1 |
| 0.12533 | 1 |
| 0.12534 | 1 |
| 0.12535 | 1 |
| 0.12536 | 1 |
| 0.12537 | 1 |
| 0.12538 | 1 |
| 0.12539 | 1 |
| 0.1254 | 1 |
| 0.12541 | 1 |
| 0.12542 | 1 |
| 0.12543 | 1 |
| 0.12544 | 1 |
| 0.12545 | 1 |
| 0.12546 | 1 |
| 0.12547 | 1 |
| 0.12548 | 1 |
| 0.12549 | 1 |
| 0.1255 | 1 |
| 0.12551 | 1 |
| 0.12552 | 1 |
| 0.12553 | 1 |
| 0.12554 | 1 |
| 0.12555 | 1 |
| 0.12556 | 1 |
| 0.12557 | 1 |
| 0.12558 | 1 |
| 0.12559 | 1 |
| 0.1256 | 1 |
| 0.12561 | 1 |
| 0.12562 | 1 |
| 0.12563 | 1 |
| 0.12564 | 1 |
| 0.12565 | 1 |
| 0.12566 | 1 |
| 0.12567 | 1 |
| 0.12568 | 1 |
| 0.12569 | 1 |
| 0.1257 | 1 |
| 0.12571 | 1 |
| 0.12572 | 1 |
| 0.12573 | 1 |
| 0.12574 | 1 |
| 0.12575 | 1 |
| 0.12576 | 1 |
| 0.12577 | 1 |
| 0.12578 | 1 |
| 0.12579 | 1 |
| 0.1258 | 1 |
| 0.12581 | 1 |
| 0.12582 | 1 |
| 0.12583 | 1 |
| 0.12584 | 1 |
| 0.12585 | 1 |
| 0.12586 | 1 |
| 0.12587 | 1 |
| 0.12588 | 1 |
| 0.12589 | 1 |
| 0.1259 | 1 |
| 0.12591 | 1 |
| 0.12592 | 1 |
| 0.12593 | 1 |
| 0.12594 | 1 |
| 0.12595 | 1 |
| 0.12596 | 1 |
| 0.12597 | 1 |
| 0.12598 | 1 |
| 0.12599 | 1 |
| 0.126 | 1 |
| 0.12601 | 1 |
| 0.12602 | 1 |
| 0.12603 | 1 |
| 0.12604 | 1 |
| 0.12605 | 1 |
| 0.12606 | 1 |
| 0.12607 | 1 |
| 0.12608 | 1 |
| 0.12609 | 1 |
| 0.1261 | 1 |
| 0.12611 | 1 |
| 0.12612 | 1 |
| 0.12613 | 1 |
| 0.12614 | 1 |
| 0.12615 | 1 |
| 0.12616 | 1 |
| 0.12617 | 1 |
| 0.12618 | 1 |
| 0.12619 | 1 |
| 0.1262 | 1 |
| 0.12621 | 1 |
| 0.12622 | 1 |
| 0.12623 | 1 |
| 0.12624 | 1 |
| 0.12625 | 1 |
| 0.12626 | 1 |
| 0.12627 | 1 |
| 0.12628 | 1 |
| 0.12629 | 1 |
| 0.1263 | 1 |
| 0.12631 | 1 |
| 0.12632 | 1 |
| 0.12633 | 1 |
| 0.12634 | 1 |
| 0.12635 | 1 |
| 0.12636 | 1 |
| 0.12637 | 1 |
| 0.12638 | 1 |
| 0.12639 | 1 |
| 0.1264 | 1 |
| 0.12641 | 1 |
| 0.12642 | 1 |
| 0.12643 | 1 |
| 0.12644 | 1 |
| 0.12645 | 1 |
| 0.12646 | 1 |
| 0.12647 | 1 |
| 0.12648 | 1 |
| 0.12649 | 1 |
| 0.1265 | 1 |
| 0.12651 | 1 |
| 0.12652 | 1 |
| 0.12653 | 1 |
| 0.12654 | 1 |
| 0.12655 | 1 |
| 0.12656 | 1 |
| 0.12657 | 1 |
| 0.12658 | 1 |
| 0.12659 | 1 |
| 0.1266 | 1 |
| 0.12661 | 1 |
| 0.12662 | 1 |
| 0.12663 | 1 |
| 0.12664 | 1 |
| 0.12665 | 1 |
| 0.12666 | 1 |
| 0.12667 | 1 |
| 0.12668 | 1 |
| 0.12669 | 1 |
| 0.1267 | 1 |
| 0.12671 | 1 |
| 0.12672 | 1 |
| 0.12673 | 1 |
| 0.12674 | 1 |
| 0.12675 | 1 |
| 0.12676 | 1 |
| 0.12677 | 1 |
| 0.12678 | 1 |
| 0.12679 | 1 |
| 0.1268 | 1 |
| 0.12681 | 1 |
| 0.12682 | 1 |
| 0.12683 | 1 |
| 0.12684 | 1 |
| 0.12685 | 1 |
| 0.12686 | 1 |
| 0.12687 | 1 |
| 0.12688 | 1 |
| 0.12689 | 1 |
| 0.1269 | 1 |
| 0.12691 | 1 |
| 0.12692 | 1 |
| 0.12693 | 1 |
| 0.12694 | 1 |
| 0.12695 | 1 |
| 0.12696 | 1 |
| 0.12697 | 1 |
| 0.12698 | 1 |
| 0.12699 | 1 |
| 0.127 | 1 |
| 0.12701 | 1 |
| 0.12702 | 1 |
| 0.12703 | 1 |
| 0.12704 | 1 |
| 0.12705 | 1 |
| 0.12706 | 1 |
| 0.12707 | 1 |
| 0.12708 | 1 |
| 0.12709 | 1 |
| 0.1271 | 1 |
| 0.12711 | 1 |
| 0.12712 | 1 |
| 0.12713 | 1 |
| 0.12714 | 1 |
| 0.12715 | 1 |
| 0.12716 | 1 |
| 0.12717 | 1 |
| 0.12718 | 1 |
| 0.12719 | 1 |
| 0.1272 | 1 |
| 0.12721 | 1 |
| 0.12722 | 1 |
| 0.12723 | 1 |
| 0.12724 | 1 |
| 0.12725 | 1 |
| 0.12726 | 1 |
| 0.12727 | 1 |
| 0.12728 | 1 |
| 0.12729 | 1 |
| 0.1273 | 1 |
| 0.12731 | 1 |
| 0.12732 | 1 |
| 0.12733 | 1 |
| 0.12734 | 1 |
| 0.12735 | 1 |
| 0.12736 | 1 |
| 0.12737 | 1 |
| 0.12738 | 1 |
| 0.12739 | 1 |
| 0.1274 | 1 |
| 0.12741 | 1 |
| 0.12742 | 1 |
| 0.12743 | 1 |
| 0.12744 | 1 |
| 0.12745 | 1 |
| 0.12746 | 1 |
| 0.12747 | 1 |
| 0.12748 | 1 |
| 0.12749 | 1 |
| 0.1275 | 1 |
| 0.12751 | 1 |
| 0.12752 | 1 |
| 0.12753 | 1 |
| 0.12754 | 1 |
| 0.12755 | 1 |
| 0.12756 | 1 |
| 0.12757 | 1 |
| 0.12758 | 1 |
| 0.12759 | 1 |
| 0.1276 | 1 |
| 0.12761 | 1 |
| 0.12762 | 1 |
| 0.12763 | 1 |
| 0.12764 | 1 |
| 0.12765 | 1 |
| 0.12766 | 1 |
| 0.12767 | 1 |
| 0.12768 | 1 |
| 0.12769 | 1 |
| 0.1277 | 1 |
| 0.12771 | 1 |
| 0.12772 | 1 |
| 0.12773 | 1 |
| 0.12774 | 1 |
| 0.12775 | 1 |
| 0.12776 | 1 |
| 0.12777 | 1 |
| 0.12778 | 1 |
| 0.12779 | 1 |
| 0.1278 | 1 |
| 0.12781 | 1 |
| 0.12782 | 1 |
| 0.12783 | 1 |
| 0.12784 | 1 |
| 0.12785 | 1 |
| 0.12786 | 1 |
| 0.12787 | 1 |
| 0.12788 | 1 |
| 0.12789 | 1 |
| 0.1279 | 1 |
| 0.12791 | 1 |
| 0.12792 | 1 |
| 0.12793 | 1 |
| 0.12794 | 1 |
| 0.12795 | 1 |
| 0.12796 | 1 |
| 0.12797 | 1 |
| 0.12798 | 1 |
| 0.12799 | 1 |
| 0.128 | 1 |
| 0.12801 | 1 |
| 0.12802 | 1 |
| 0.12803 | 1 |
| 0.12804 | 1 |
| 0.12805 | 1 |
| 0.12806 | 1 |
| 0.12807 | 1 |
| 0.12808 | 1 |
| 0.12809 | 1 |
| 0.1281 | 1 |
| 0.12811 | 1 |
| 0.12812 | 1 |
| 0.12813 | 1 |
| 0.12814 | 1 |
| 0.12815 | 1 |
| 0.12816 | 1 |
| 0.12817 | 1 |
| 0.12818 | 1 |
| 0.12819 | 1 |
| 0.1282 | 1 |
| 0.12821 | 1 |
| 0.12822 | 1 |
| 0.12823 | 1 |
| 0.12824 | 1 |
| 0.12825 | 1 |
| 0.12826 | 1 |
| 0.12827 | 1 |
| 0.12828 | 1 |
| 0.12829 | 1 |
| 0.1283 | 1 |
| 0.12831 | 1 |
| 0.12832 | 1 |
| 0.12833 | 1 |
| 0.12834 | 1 |
| 0.12835 | 1 |
| 0.12836 | 1 |
| 0.12837 | 1 |
| 0.12838 | 1 |
| 0.12839 | 1 |
| 0.1284 | 1 |
| 0.12841 | 1 |
| 0.12842 | 1 |
| 0.12843 | 1 |
| 0.12844 | 1 |
| 0.12845 | 1 |
| 0.12846 | 1 |
| 0.12847 | 1 |
| 0.12848 | 1 |
| 0.12849 | 1 |
| 0.1285 | 1 |
| 0.12851 | 1 |
| 0.12852 | 1 |
| 0.12853 | 1 |
| 0.12854 | 1 |
| 0.12855 | 1 |
| 0.12856 | 1 |
| 0.12857 | 1 |
| 0.12858 | 1 |
| 0.12859 | 1 |
| 0.1286 | 1 |
| 0.12861 | 1 |
| 0.12862 | 1 |
| 0.12863 | 1 |
| 0.12864 | 1 |
| 0.12865 | 1 |
| 0.12866 | 1 |
| 0.12867 | 1 |
| 0.12868 | 1 |
| 0.12869 | 1 |
| 0.1287 | 1 |
| 0.12871 | 1 |
| 0.12872 | 1 |
| 0.12873 | 1 |
| 0.12874 | 1 |
| 0.12875 | 1 |
| 0.12876 | 1 |
| 0.12877 | 1 |
| 0.12878 | 1 |
| 0.12879 | 1 |
| 0.1288 | 1 |
| 0.12881 | 1 |
| 0.12882 | 1 |
| 0.12883 | 1 |
| 0.12884 | 1 |
| 0.12885 | 1 |
| 0.12886 | 1 |
| 0.12887 | 1 |
| 0.12888 | 1 |
| 0.12889 | 1 |
| 0.1289 | 1 |
| 0.12891 | 1 |
| 0.12892 | 1 |
| 0.12893 | 1 |
| 0.12894 | 1 |
| 0.12895 | 1 |
| 0.12896 | 1 |
| 0.12897 | 1 |
| 0.12898 | 1 |
| 0.12899 | 0.999 |
| 0.129 | 0.999 |
| 0.12901 | 0.999 |
| 0.12902 | 0.999 |
| 0.12903 | 0.999 |
| 0.12904 | 0.999 |
| 0.12905 | 0.999 |
| 0.12906 | 0.999 |
| 0.12907 | 0.999 |
| 0.12908 | 0.999 |
| 0.12909 | 0.999 |
| 0.1291 | 0.999 |
| 0.12911 | 0.999 |
| 0.12912 | 0.999 |
| 0.12913 | 0.999 |
| 0.12914 | 0.999 |
| 0.12915 | 0.999 |
| 0.12916 | 0.999 |
| 0.12917 | 0.999 |
| 0.12918 | 0.999 |
| 0.12919 | 0.999 |
| 0.1292 | 0.999 |
| 0.12921 | 0.999 |
| 0.12922 | 0.999 |
| 0.12923 | 0.999 |
| 0.12924 | 0.999 |
| 0.12925 | 0.999 |
| 0.12926 | 0.999 |
| 0.12927 | 0.999 |
| 0.12928 | 0.999 |
| 0.12929 | 0.999 |
| 0.1293 | 0.999 |
| 0.12931 | 0.999 |
| 0.12932 | 0.999 |
| 0.12933 | 0.999 |
| 0.12934 | 0.999 |
| 0.12935 | 0.999 |
| 0.12936 | 0.999 |
| 0.12937 | 0.999 |
| 0.12938 | 0.999 |
| 0.12939 | 0.999 |
| 0.1294 | 0.999 |
| 0.12941 | 0.999 |
| 0.12942 | 0.999 |
| 0.12943 | 0.999 |
| 0.12944 | 0.999 |
| 0.12945 | 0.999 |
| 0.12946 | 0.999 |
| 0.12947 | 0.999 |
| 0.12948 | 0.999 |
| 0.12949 | 0.999 |
| 0.1295 | 0.999 |
| 0.12951 | 0.999 |
| 0.12952 | 0.999 |
| 0.12953 | 0.999 |
| 0.12954 | 0.999 |
| 0.12955 | 0.999 |
| 0.12956 | 0.999 |
| 0.12957 | 0.999 |
| 0.12958 | 0.999 |
| 0.12959 | 0.999 |
| 0.1296 | 0.999 |
| 0.12961 | 0.999 |
| 0.12962 | 0.999 |
| 0.12963 | 0.999 |
| 0.12964 | 0.999 |
| 0.12965 | 0.999 |
| 0.12966 | 0.999 |
| 0.12967 | 0.999 |
| 0.12968 | 0.999 |
| 0.12969 | 0.999 |
| 0.1297 | 0.999 |
| 0.12971 | 0.999 |
| 0.12972 | 0.999 |
| 0.12973 | 0.999 |
| 0.12974 | 0.999 |
| 0.12975 | 0.999 |
| 0.12976 | 0.999 |
| 0.12977 | 0.999 |
| 0.12978 | 0.999 |
| 0.12979 | 0.999 |
| 0.1298 | 0.999 |
| 0.12981 | 0.999 |
| 0.12982 | 0.999 |
| 0.12983 | 0.999 |
| 0.12984 | 0.999 |
| 0.12985 | 0.999 |
| 0.12986 | 0.999 |
| 0.12987 | 0.999 |
| 0.12988 | 0.999 |
| 0.12989 | 0.999 |
| 0.1299 | 0.999 |
| 0.12991 | 0.999 |
| 0.12992 | 0.999 |
| 0.12993 | 0.999 |
| 0.12994 | 0.999 |
| 0.12995 | 0.999 |
| 0.12996 | 0.999 |
| 0.12997 | 0.999 |
| 0.12998 | 0.999 |
| 0.12999 | 0.999 |
| 0.13 | 0.999 |
| 0.13001 | 0.999 |
| 0.13002 | 0.999 |
| 0.13003 | 0.999 |
| 0.13004 | 0.999 |
| 0.13005 | 0.999 |
| 0.13006 | 0.999 |
| 0.13007 | 0.999 |
| 0.13008 | 0.999 |
| 0.13009 | 0.999 |
| 0.1301 | 0.999 |
| 0.13011 | 0.999 |
| 0.13012 | 0.999 |
| 0.13013 | 0.999 |
| 0.13014 | 0.999 |
| 0.13015 | 0.999 |
| 0.13016 | 0.999 |
| 0.13017 | 0.999 |
| 0.13018 | 0.999 |
| 0.13019 | 0.999 |
| 0.1302 | 0.999 |
| 0.13021 | 0.999 |
| 0.13022 | 0.999 |
| 0.13023 | 0.999 |
| 0.13024 | 0.999 |
| 0.13025 | 0.999 |
| 0.13026 | 0.999 |
| 0.13027 | 0.999 |
| 0.13028 | 0.999 |
| 0.13029 | 0.999 |
| 0.1303 | 0.999 |
| 0.13031 | 0.999 |
| 0.13032 | 0.999 |
| 0.13033 | 0.999 |
| 0.13034 | 0.999 |
| 0.13035 | 0.999 |
| 0.13036 | 0.999 |
| 0.13037 | 0.999 |
| 0.13038 | 0.999 |
| 0.13039 | 0.999 |
| 0.1304 | 0.999 |
| 0.13041 | 0.999 |
| 0.13042 | 0.999 |
| 0.13043 | 0.999 |
| 0.13044 | 0.999 |
| 0.13045 | 0.999 |
| 0.13046 | 0.999 |
| 0.13047 | 0.999 |
| 0.13048 | 0.999 |
| 0.13049 | 0.999 |
| 0.1305 | 0.999 |
| 0.13051 | 0.999 |
| 0.13052 | 0.999 |
| 0.13053 | 0.999 |
| 0.13054 | 0.999 |
| 0.13055 | 0.999 |
| 0.13056 | 0.999 |
| 0.13057 | 0.999 |
| 0.13058 | 0.999 |
| 0.13059 | 0.999 |
| 0.1306 | 0.999 |
| 0.13061 | 0.999 |
| 0.13062 | 0.999 |
| 0.13063 | 0.999 |
| 0.13064 | 0.999 |
| 0.13065 | 0.999 |
| 0.13066 | 0.999 |
| 0.13067 | 0.999 |
| 0.13068 | 0.999 |
| 0.13069 | 0.999 |
| 0.1307 | 0.999 |
| 0.13071 | 0.999 |
| 0.13072 | 0.999 |
| 0.13073 | 0.999 |
| 0.13074 | 0.999 |
| 0.13075 | 0.999 |
| 0.13076 | 0.999 |
| 0.13077 | 0.999 |
| 0.13078 | 0.999 |
| 0.13079 | 0.999 |
| 0.1308 | 0.999 |
| 0.13081 | 0.999 |
| 0.13082 | 0.999 |
| 0.13083 | 0.999 |
| 0.13084 | 0.999 |
| 0.13085 | 0.999 |
| 0.13086 | 0.999 |
| 0.13087 | 0.999 |
| 0.13088 | 0.999 |
| 0.13089 | 0.999 |
| 0.1309 | 0.999 |
| 0.13091 | 0.999 |
| 0.13092 | 0.999 |
| 0.13093 | 0.999 |
| 0.13094 | 0.999 |
| 0.13095 | 0.999 |
| 0.13096 | 0.999 |
| 0.13097 | 0.999 |
| 0.13098 | 0.999 |
| 0.13099 | 0.999 |
| 0.131 | 0.999 |
| 0.13101 | 0.999 |
| 0.13102 | 0.999 |
| 0.13103 | 0.999 |
| 0.13104 | 0.999 |
| 0.13105 | 0.999 |
| 0.13106 | 0.999 |
| 0.13107 | 0.999 |
| 0.13108 | 0.999 |
| 0.13109 | 0.999 |
| 0.1311 | 0.999 |
| 0.13111 | 0.999 |
| 0.13112 | 0.999 |
| 0.13113 | 0.999 |
| 0.13114 | 0.999 |
| 0.13115 | 0.999 |
| 0.13116 | 0.999 |
| 0.13117 | 0.999 |
| 0.13118 | 0.999 |
| 0.13119 | 0.999 |
| 0.1312 | 0.999 |
| 0.13121 | 0.999 |
| 0.13122 | 0.999 |
| 0.13123 | 0.999 |
| 0.13124 | 0.999 |
| 0.13125 | 0.999 |
| 0.13126 | 0.999 |
| 0.13127 | 0.999 |
| 0.13128 | 0.999 |
| 0.13129 | 0.999 |
| 0.1313 | 0.999 |
| 0.13131 | 0.999 |
| 0.13132 | 0.999 |
| 0.13133 | 0.999 |
| 0.13134 | 0.999 |
| 0.13135 | 0.999 |
| 0.13136 | 0.999 |
| 0.13137 | 0.999 |
| 0.13138 | 0.999 |
| 0.13139 | 0.999 |
| 0.1314 | 0.999 |
| 0.13141 | 0.999 |
| 0.13142 | 0.999 |
| 0.13143 | 0.999 |
| 0.13144 | 0.999 |
| 0.13145 | 0.999 |
| 0.13146 | 0.999 |
| 0.13147 | 0.999 |
| 0.13148 | 0.999 |
| 0.13149 | 0.999 |
| 0.1315 | 0.999 |
| 0.13151 | 0.999 |
| 0.13152 | 0.999 |
| 0.13153 | 0.999 |
| 0.13154 | 0.999 |
| 0.13155 | 0.999 |
| 0.13156 | 0.999 |
| 0.13157 | 0.999 |
| 0.13158 | 0.999 |
| 0.13159 | 0.999 |
| 0.1316 | 0.999 |
| 0.13161 | 0.999 |
| 0.13162 | 0.999 |
| 0.13163 | 0.999 |
| 0.13164 | 0.999 |
| 0.13165 | 0.999 |
| 0.13166 | 0.999 |
| 0.13167 | 0.999 |
| 0.13168 | 0.999 |
| 0.13169 | 0.999 |
| 0.1317 | 0.999 |
| 0.13171 | 0.999 |
| 0.13172 | 0.999 |
| 0.13173 | 0.999 |
| 0.13174 | 0.999 |
| 0.13175 | 0.999 |
| 0.13176 | 0.999 |
| 0.13177 | 0.999 |
| 0.13178 | 0.999 |
| 0.13179 | 0.999 |
| 0.1318 | 0.999 |
| 0.13181 | 0.999 |
| 0.13182 | 0.999 |
| 0.13183 | 0.999 |
| 0.13184 | 0.999 |
| 0.13185 | 0.999 |
| 0.13186 | 0.999 |
| 0.13187 | 0.999 |
| 0.13188 | 0.999 |
| 0.13189 | 0.999 |
| 0.1319 | 0.999 |
| 0.13191 | 0.999 |
| 0.13192 | 0.999 |
| 0.13193 | 0.999 |
| 0.13194 | 0.999 |
| 0.13195 | 0.999 |
| 0.13196 | 0.999 |
| 0.13197 | 0.999 |
| 0.13198 | 0.999 |
| 0.13199 | 0.999 |
| 0.132 | 0.999 |
| 0.13201 | 0.999 |
| 0.13202 | 0.999 |
| 0.13203 | 0.999 |
| 0.13204 | 0.999 |
| 0.13205 | 0.999 |
| 0.13206 | 0.999 |
| 0.13207 | 0.999 |
| 0.13208 | 0.999 |
| 0.13209 | 0.999 |
| 0.1321 | 0.999 |
| 0.13211 | 0.999 |
| 0.13212 | 0.999 |
| 0.13213 | 0.999 |
| 0.13214 | 0.999 |
| 0.13215 | 0.999 |
| 0.13216 | 0.999 |
| 0.13217 | 0.999 |
| 0.13218 | 0.999 |
| 0.13219 | 0.999 |
| 0.1322 | 0.999 |
| 0.13221 | 0.999 |
| 0.13222 | 0.999 |
| 0.13223 | 0.999 |
| 0.13224 | 0.999 |
| 0.13225 | 0.999 |
| 0.13226 | 0.999 |
| 0.13227 | 0.999 |
| 0.13228 | 0.999 |
| 0.13229 | 0.999 |
| 0.1323 | 0.999 |
| 0.13231 | 0.999 |
| 0.13232 | 0.999 |
| 0.13233 | 0.999 |
| 0.13234 | 0.999 |
| 0.13235 | 0.999 |
| 0.13236 | 0.999 |
| 0.13237 | 0.999 |
| 0.13238 | 0.999 |
| 0.13239 | 0.999 |
| 0.1324 | 0.999 |
| 0.13241 | 0.999 |
| 0.13242 | 0.999 |
| 0.13243 | 0.999 |
| 0.13244 | 0.999 |
| 0.13245 | 0.999 |
| 0.13246 | 0.999 |
| 0.13247 | 0.999 |
| 0.13248 | 0.999 |
| 0.13249 | 0.999 |
| 0.1325 | 0.999 |
| 0.13251 | 0.999 |
| 0.13252 | 0.999 |
| 0.13253 | 0.999 |
| 0.13254 | 0.999 |
| 0.13255 | 0.999 |
| 0.13256 | 0.999 |
| 0.13257 | 0.999 |
| 0.13258 | 0.999 |
| 0.13259 | 0.999 |
| 0.1326 | 0.999 |
| 0.13261 | 0.999 |
| 0.13262 | 0.999 |
| 0.13263 | 0.999 |
| 0.13264 | 0.999 |
| 0.13265 | 0.999 |
| 0.13266 | 0.999 |
| 0.13267 | 0.999 |
| 0.13268 | 0.999 |
| 0.13269 | 0.999 |
| 0.1327 | 0.999 |
| 0.13271 | 0.999 |
| 0.13272 | 0.999 |
| 0.13273 | 0.999 |
| 0.13274 | 0.999 |
| 0.13275 | 0.999 |
| 0.13276 | 0.999 |
| 0.13277 | 0.999 |
| 0.13278 | 0.999 |
| 0.13279 | 0.999 |
| 0.1328 | 0.999 |
| 0.13281 | 0.999 |
| 0.13282 | 0.999 |
| 0.13283 | 0.999 |
| 0.13284 | 0.999 |
| 0.13285 | 0.999 |
| 0.13286 | 0.999 |
| 0.13287 | 0.999 |
| 0.13288 | 0.999 |
| 0.13289 | 0.999 |
| 0.1329 | 0.999 |
| 0.13291 | 0.999 |
| 0.13292 | 0.999 |
| 0.13293 | 0.999 |
| 0.13294 | 0.999 |
| 0.13295 | 0.999 |
| 0.13296 | 0.999 |
| 0.13297 | 0.999 |
| 0.13298 | 0.999 |
| 0.13299 | 0.999 |
| 0.133 | 0.999 |
| 0.13301 | 0.999 |
| 0.13302 | 0.999 |
| 0.13303 | 0.999 |
| 0.13304 | 0.999 |
| 0.13305 | 0.999 |
| 0.13306 | 0.999 |
| 0.13307 | 0.999 |
| 0.13308 | 0.999 |
| 0.13309 | 0.999 |
| 0.1331 | 0.999 |
| 0.13311 | 0.999 |
| 0.13312 | 0.999 |
| 0.13313 | 0.999 |
| 0.13314 | 0.999 |
| 0.13315 | 0.999 |
| 0.13316 | 0.999 |
| 0.13317 | 0.999 |
| 0.13318 | 0.999 |
| 0.13319 | 0.999 |
| 0.1332 | 0.999 |
| 0.13321 | 0.999 |
| 0.13322 | 0.999 |
| 0.13323 | 0.999 |
| 0.13324 | 0.999 |
| 0.13325 | 0.999 |
| 0.13326 | 0.999 |
| 0.13327 | 0.999 |
| 0.13328 | 0.999 |
| 0.13329 | 0.999 |
| 0.1333 | 0.999 |
| 0.13331 | 0.999 |
| 0.13332 | 0.999 |
| 0.13333 | 0.999 |
| 0.13334 | 0.999 |
| 0.13335 | 0.999 |
| 0.13336 | 0.999 |
| 0.13337 | 0.999 |
| 0.13338 | 0.999 |
| 0.13339 | 0.999 |
| 0.1334 | 0.999 |
| 0.13341 | 0.999 |
| 0.13342 | 0.999 |
| 0.13343 | 0.999 |
| 0.13344 | 0.999 |
| 0.13345 | 0.999 |
| 0.13346 | 0.999 |
| 0.13347 | 0.999 |
| 0.13348 | 0.999 |
| 0.13349 | 0.999 |
| 0.1335 | 0.999 |
| 0.13351 | 0.999 |
| 0.13352 | 0.999 |
| 0.13353 | 0.999 |
| 0.13354 | 0.999 |
| 0.13355 | 0.999 |
| 0.13356 | 0.999 |
| 0.13357 | 0.999 |
| 0.13358 | 0.999 |
| 0.13359 | 0.999 |
| 0.1336 | 0.999 |
| 0.13361 | 0.999 |
| 0.13362 | 0.999 |
| 0.13363 | 0.999 |
| 0.13364 | 0.999 |
| 0.13365 | 0.999 |
| 0.13366 | 0.999 |
| 0.13367 | 0.999 |
| 0.13368 | 0.999 |
| 0.13369 | 0.999 |
| 0.1337 | 0.999 |
| 0.13371 | 0.999 |
| 0.13372 | 0.999 |
| 0.13373 | 0.999 |
| 0.13374 | 0.999 |
| 0.13375 | 0.999 |
| 0.13376 | 0.999 |
| 0.13377 | 0.999 |
| 0.13378 | 0.999 |
| 0.13379 | 0.999 |
| 0.1338 | 0.999 |
| 0.13381 | 0.999 |
| 0.13382 | 0.999 |
| 0.13383 | 0.999 |
| 0.13384 | 0.999 |
| 0.13385 | 0.999 |
| 0.13386 | 0.999 |
| 0.13387 | 0.999 |
| 0.13388 | 0.999 |
| 0.13389 | 0.999 |
| 0.1339 | 0.999 |
| 0.13391 | 0.999 |
| 0.13392 | 0.999 |
| 0.13393 | 0.999 |
| 0.13394 | 0.999 |
| 0.13395 | 0.999 |
| 0.13396 | 0.999 |
| 0.13397 | 0.999 |
| 0.13398 | 0.999 |
| 0.13399 | 0.999 |
| 0.134 | 0.999 |
| 0.13401 | 0.999 |
| 0.13402 | 0.999 |
| 0.13403 | 0.999 |
| 0.13404 | 0.999 |
| 0.13405 | 0.999 |
| 0.13406 | 0.999 |
| 0.13407 | 0.999 |
| 0.13408 | 0.999 |
| 0.13409 | 0.999 |
| 0.1341 | 0.999 |
| 0.13411 | 0.999 |
| 0.13412 | 0.999 |
| 0.13413 | 0.999 |
| 0.13414 | 0.999 |
| 0.13415 | 0.999 |
| 0.13416 | 0.999 |
| 0.13417 | 0.999 |
| 0.13418 | 0.999 |
| 0.13419 | 0.999 |
| 0.1342 | 0.999 |
| 0.13421 | 0.999 |
| 0.13422 | 0.999 |
| 0.13423 | 0.999 |
| 0.13424 | 0.999 |
| 0.13425 | 0.999 |
| 0.13426 | 0.999 |
| 0.13427 | 0.999 |
| 0.13428 | 0.999 |
| 0.13429 | 0.999 |
| 0.1343 | 0.999 |
| 0.13431 | 0.999 |
| 0.13432 | 0.999 |
| 0.13433 | 0.999 |
| 0.13434 | 0.999 |
| 0.13435 | 0.999 |
| 0.13436 | 0.999 |
| 0.13437 | 0.999 |
| 0.13438 | 0.999 |
| 0.13439 | 0.999 |
| 0.1344 | 0.999 |
| 0.13441 | 0.999 |
| 0.13442 | 0.999 |
| 0.13443 | 0.999 |
| 0.13444 | 0.999 |
| 0.13445 | 0.999 |
| 0.13446 | 0.999 |
| 0.13447 | 0.999 |
| 0.13448 | 0.999 |
| 0.13449 | 0.999 |
| 0.1345 | 0.999 |
| 0.13451 | 0.999 |
| 0.13452 | 0.999 |
| 0.13453 | 0.999 |
| 0.13454 | 0.999 |
| 0.13455 | 0.999 |
| 0.13456 | 0.999 |
| 0.13457 | 0.999 |
| 0.13458 | 0.999 |
| 0.13459 | 0.999 |
| 0.1346 | 0.999 |
| 0.13461 | 0.999 |
| 0.13462 | 0.999 |
| 0.13463 | 0.999 |
| 0.13464 | 0.999 |
| 0.13465 | 0.999 |
| 0.13466 | 0.999 |
| 0.13467 | 0.999 |
| 0.13468 | 0.999 |
| 0.13469 | 0.999 |
| 0.1347 | 0.999 |
| 0.13471 | 0.999 |
| 0.13472 | 0.999 |
| 0.13473 | 0.999 |
| 0.13474 | 0.999 |
| 0.13475 | 0.999 |
| 0.13476 | 0.999 |
| 0.13477 | 0.999 |
| 0.13478 | 0.999 |
| 0.13479 | 0.999 |
| 0.1348 | 0.999 |
| 0.13481 | 0.999 |
| 0.13482 | 0.999 |
| 0.13483 | 0.999 |
| 0.13484 | 0.999 |
| 0.13485 | 0.999 |
| 0.13486 | 0.999 |
| 0.13487 | 0.999 |
| 0.13488 | 0.999 |
| 0.13489 | 0.999 |
| 0.1349 | 0.999 |
| 0.13491 | 0.999 |
| 0.13492 | 0.999 |
| 0.13493 | 0.999 |
| 0.13494 | 0.999 |
| 0.13495 | 0.999 |
| 0.13496 | 0.999 |
| 0.13497 | 0.999 |
| 0.13498 | 0.999 |
| 0.13499 | 0.999 |
| 0.135 | 0.999 |
| 0.13501 | 0.999 |
| 0.13502 | 0.999 |
| 0.13503 | 0.999 |
| 0.13504 | 0.999 |
| 0.13505 | 0.999 |
| 0.13506 | 0.999 |
| 0.13507 | 0.999 |
| 0.13508 | 0.999 |
| 0.13509 | 0.999 |
| 0.1351 | 0.999 |
| 0.13511 | 0.999 |
| 0.13512 | 0.999 |
| 0.13513 | 0.999 |
| 0.13514 | 0.999 |
| 0.13515 | 0.999 |
| 0.13516 | 0.999 |
| 0.13517 | 0.999 |
| 0.13518 | 0.999 |
| 0.13519 | 0.999 |
| 0.1352 | 0.999 |
| 0.13521 | 0.999 |
| 0.13522 | 0.999 |
| 0.13523 | 0.999 |
| 0.13524 | 0.999 |
| 0.13525 | 0.999 |
| 0.13526 | 0.999 |
| 0.13527 | 0.999 |
| 0.13528 | 0.999 |
| 0.13529 | 0.999 |
| 0.1353 | 0.999 |
| 0.13531 | 0.999 |
| 0.13532 | 0.999 |
| 0.13533 | 0.999 |
| 0.13534 | 0.999 |
| 0.13535 | 0.999 |
| 0.13536 | 0.999 |
| 0.13537 | 0.999 |
| 0.13538 | 0.999 |
| 0.13539 | 0.999 |
| 0.1354 | 0.999 |
| 0.13541 | 0.999 |
| 0.13542 | 0.999 |
| 0.13543 | 0.999 |
| 0.13544 | 0.999 |
| 0.13545 | 0.999 |
| 0.13546 | 0.999 |
| 0.13547 | 0.999 |
| 0.13548 | 0.999 |
| 0.13549 | 0.999 |
| 0.1355 | 0.999 |
| 0.13551 | 0.999 |
| 0.13552 | 0.999 |
| 0.13553 | 0.999 |
| 0.13554 | 0.999 |
| 0.13555 | 0.999 |
| 0.13556 | 0.999 |
| 0.13557 | 0.999 |
| 0.13558 | 0.999 |
| 0.13559 | 0.999 |
| 0.1356 | 0.999 |
| 0.13561 | 0.999 |
| 0.13562 | 0.999 |
| 0.13563 | 0.999 |
| 0.13564 | 0.999 |
| 0.13565 | 0.999 |
| 0.13566 | 0.999 |
| 0.13567 | 0.999 |
| 0.13568 | 0.999 |
| 0.13569 | 0.999 |
| 0.1357 | 0.999 |
| 0.13571 | 0.999 |
| 0.13572 | 0.999 |
| 0.13573 | 0.999 |
| 0.13574 | 0.999 |
| 0.13575 | 0.999 |
| 0.13576 | 0.999 |
| 0.13577 | 0.999 |
| 0.13578 | 0.999 |
| 0.13579 | 0.999 |
| 0.1358 | 0.999 |
| 0.13581 | 0.999 |
| 0.13582 | 0.999 |
| 0.13583 | 0.999 |
| 0.13584 | 0.999 |
| 0.13585 | 0.999 |
| 0.13586 | 0.999 |
| 0.13587 | 0.999 |
| 0.13588 | 0.999 |
| 0.13589 | 0.999 |
| 0.1359 | 0.999 |
| 0.13591 | 0.999 |
| 0.13592 | 0.999 |
| 0.13593 | 0.999 |
| 0.13594 | 0.999 |
| 0.13595 | 0.999 |
| 0.13596 | 1 |
| 0.13597 | 1 |
| 0.13598 | 1 |
| 0.13599 | 1 |
| 0.136 | 1 |
| 0.13601 | 1 |
| 0.13602 | 1 |
| 0.13603 | 1 |
| 0.13604 | 1 |
| 0.13605 | 1 |
| 0.13606 | 1 |
| 0.13607 | 1 |
| 0.13608 | 1 |
| 0.13609 | 1 |
| 0.1361 | 1 |
| 0.13611 | 1 |
| 0.13612 | 1 |
| 0.13613 | 1 |
| 0.13614 | 1 |
| 0.13615 | 1 |
| 0.13616 | 1 |
| 0.13617 | 1 |
| 0.13618 | 1 |
| 0.13619 | 1 |
| 0.1362 | 1 |
| 0.13621 | 1 |
| 0.13622 | 1 |
| 0.13623 | 1 |
| 0.13624 | 1 |
| 0.13625 | 1 |
| 0.13626 | 1 |
| 0.13627 | 1 |
| 0.13628 | 1 |
| 0.13629 | 1 |
| 0.1363 | 1 |
| 0.13631 | 1 |
| 0.13632 | 1 |
| 0.13633 | 1 |
| 0.13634 | 1 |
| 0.13635 | 1 |
| 0.13636 | 1 |
| 0.13637 | 1 |
| 0.13638 | 1 |
| 0.13639 | 1 |
| 0.1364 | 1 |
| 0.13641 | 1 |
| 0.13642 | 1 |
| 0.13643 | 1 |
| 0.13644 | 1 |
| 0.13645 | 1 |
| 0.13646 | 1 |
| 0.13647 | 1 |
| 0.13648 | 1 |
| 0.13649 | 1 |
| 0.1365 | 1 |
| 0.13651 | 1 |
| 0.13652 | 1 |
| 0.13653 | 1 |
| 0.13654 | 1 |
| 0.13655 | 1 |
| 0.13656 | 1 |
| 0.13657 | 1 |
| 0.13658 | 1 |
| 0.13659 | 1 |
| 0.1366 | 1 |
| 0.13661 | 1 |
| 0.13662 | 1 |
| 0.13663 | 1 |
| 0.13664 | 1 |
| 0.13665 | 1 |
| 0.13666 | 1 |
| 0.13667 | 1 |
| 0.13668 | 1 |
| 0.13669 | 1 |
| 0.1367 | 1 |
| 0.13671 | 1 |
| 0.13672 | 1 |
| 0.13673 | 1 |
| 0.13674 | 1 |
| 0.13675 | 1 |
| 0.13676 | 1 |
| 0.13677 | 1 |
| 0.13678 | 1 |
| 0.13679 | 1 |
| 0.1368 | 1 |
| 0.13681 | 1 |
| 0.13682 | 1 |
| 0.13683 | 1 |
| 0.13684 | 1 |
| 0.13685 | 1 |
| 0.13686 | 1 |
| 0.13687 | 1 |
| 0.13688 | 1 |
| 0.13689 | 1 |
| 0.1369 | 1 |
| 0.13691 | 1 |
| 0.13692 | 1 |
| 0.13693 | 1 |
| 0.13694 | 1 |
| 0.13695 | 1 |
| 0.13696 | 1 |
| 0.13697 | 1 |
| 0.13698 | 1 |
| 0.13699 | 1 |
| 0.137 | 1 |
| 0.13701 | 1 |
| 0.13702 | 1 |
| 0.13703 | 1 |
| 0.13704 | 1 |
| 0.13705 | 1 |
| 0.13706 | 1 |
| 0.13707 | 1 |
| 0.13708 | 1 |
| 0.13709 | 1 |
| 0.1371 | 1 |
| 0.13711 | 1 |
| 0.13712 | 1 |
| 0.13713 | 1 |
| 0.13714 | 1 |
| 0.13715 | 1 |
| 0.13716 | 1 |
| 0.13717 | 1 |
| 0.13718 | 1 |
| 0.13719 | 1 |
| 0.1372 | 1 |
| 0.13721 | 1 |
| 0.13722 | 1 |
| 0.13723 | 1 |
| 0.13724 | 1 |
| 0.13725 | 1 |
| 0.13726 | 1 |
| 0.13727 | 1 |
| 0.13728 | 1 |
| 0.13729 | 1 |
| 0.1373 | 1 |
| 0.13731 | 1 |
| 0.13732 | 1 |
| 0.13733 | 1 |
| 0.13734 | 1 |
| 0.13735 | 1 |
| 0.13736 | 1 |
| 0.13737 | 1 |
| 0.13738 | 1 |
| 0.13739 | 1 |
| 0.1374 | 1 |
| 0.13741 | 1 |
| 0.13742 | 1 |
| 0.13743 | 1 |
| 0.13744 | 1 |
| 0.13745 | 1 |
| 0.13746 | 1 |
| 0.13747 | 1 |
| 0.13748 | 1 |
| 0.13749 | 1 |
| 0.1375 | 1 |
| 0.13751 | 1 |
| 0.13752 | 1 |
| 0.13753 | 1 |
| 0.13754 | 1 |
| 0.13755 | 1 |
| 0.13756 | 1 |
| 0.13757 | 1 |
| 0.13758 | 1 |
| 0.13759 | 1 |
| 0.1376 | 1 |
| 0.13761 | 1 |
| 0.13762 | 1 |
| 0.13763 | 1 |
| 0.13764 | 1 |
| 0.13765 | 1 |
| 0.13766 | 1 |
| 0.13767 | 1 |
| 0.13768 | 1 |
| 0.13769 | 1 |
| 0.1377 | 1 |
| 0.13771 | 1 |
| 0.13772 | 1 |
| 0.13773 | 1 |
| 0.13774 | 1 |
| 0.13775 | 1 |
| 0.13776 | 1 |
| 0.13777 | 1 |
| 0.13778 | 1 |
| 0.13779 | 1 |
| 0.1378 | 1 |
| 0.13781 | 1 |
| 0.13782 | 1 |
| 0.13783 | 1 |
| 0.13784 | 1 |
| 0.13785 | 1 |
| 0.13786 | 1 |
| 0.13787 | 1 |
| 0.13788 | 1 |
| 0.13789 | 1 |
| 0.1379 | 1 |
| 0.13791 | 1 |
| 0.13792 | 1 |
| 0.13793 | 1 |
| 0.13794 | 1 |
| 0.13795 | 1 |
| 0.13796 | 1 |
| 0.13797 | 1 |
| 0.13798 | 1 |
| 0.13799 | 1 |
| 0.138 | 1 |
| 0.13801 | 1 |
| 0.13802 | 1 |
| 0.13803 | 1 |
| 0.13804 | 1 |
| 0.13805 | 1 |
| 0.13806 | 1 |
| 0.13807 | 1 |
| 0.13808 | 1 |
| 0.13809 | 1 |
| 0.1381 | 1 |
| 0.13811 | 1 |
| 0.13812 | 1 |
| 0.13813 | 1 |
| 0.13814 | 1 |
| 0.13815 | 1 |
| 0.13816 | 1 |
| 0.13817 | 1 |
| 0.13818 | 1 |
| 0.13819 | 1 |
| 0.1382 | 1 |
| 0.13821 | 1 |
| 0.13822 | 1 |
| 0.13823 | 1 |
| 0.13824 | 1 |
| 0.13825 | 1 |
| 0.13826 | 1 |
| 0.13827 | 1 |
| 0.13828 | 1 |
| 0.13829 | 1 |
| 0.1383 | 1 |
| 0.13831 | 1 |
| 0.13832 | 1 |
| 0.13833 | 1 |
| 0.13834 | 1 |
| 0.13835 | 1 |
| 0.13836 | 1 |
| 0.13837 | 1 |
| 0.13838 | 1 |
| 0.13839 | 1 |
| 0.1384 | 1 |
| 0.13841 | 1 |
| 0.13842 | 1 |
| 0.13843 | 1 |
| 0.13844 | 1 |
| 0.13845 | 1 |
| 0.13846 | 1 |
| 0.13847 | 1 |
| 0.13848 | 1 |
| 0.13849 | 1 |
| 0.1385 | 1 |
| 0.13851 | 1 |
| 0.13852 | 1 |
| 0.13853 | 1 |
| 0.13854 | 1 |
| 0.13855 | 1 |
| 0.13856 | 1 |
| 0.13857 | 1 |
| 0.13858 | 1 |
| 0.13859 | 1 |
| 0.1386 | 1 |
| 0.13861 | 1 |
| 0.13862 | 1 |
| 0.13863 | 1 |
| 0.13864 | 1 |
| 0.13865 | 1 |
| 0.13866 | 1 |
| 0.13867 | 1 |
| 0.13868 | 1 |
| 0.13869 | 1 |
| 0.1387 | 1 |
| 0.13871 | 1 |
| 0.13872 | 1 |
| 0.13873 | 1 |
| 0.13874 | 1 |
| 0.13875 | 1 |
| 0.13876 | 1 |
| 0.13877 | 1 |
| 0.13878 | 1 |
| 0.13879 | 1 |
| 0.1388 | 1 |
| 0.13881 | 1 |
| 0.13882 | 1 |
| 0.13883 | 1 |
| 0.13884 | 1 |
| 0.13885 | 1 |
| 0.13886 | 1 |
| 0.13887 | 1 |
| 0.13888 | 1 |
| 0.13889 | 1 |
| 0.1389 | 1 |
| 0.13891 | 1 |
| 0.13892 | 1 |
| 0.13893 | 1 |
| 0.13894 | 1 |
| 0.13895 | 1 |
| 0.13896 | 1 |
| 0.13897 | 1 |
| 0.13898 | 1 |
| 0.13899 | 1 |
| 0.139 | 1 |
| 0.13901 | 1 |
| 0.13902 | 1 |
| 0.13903 | 1 |
| 0.13904 | 1 |
| 0.13905 | 1 |
| 0.13906 | 1 |
| 0.13907 | 1 |
| 0.13908 | 1 |
| 0.13909 | 1 |
| 0.1391 | 1 |
| 0.13911 | 1 |
| 0.13912 | 1 |
| 0.13913 | 1 |
| 0.13914 | 1 |
| 0.13915 | 1 |
| 0.13916 | 1 |
| 0.13917 | 1 |
| 0.13918 | 1 |
| 0.13919 | 1 |
| 0.1392 | 1 |
| 0.13921 | 1 |
| 0.13922 | 1 |
| 0.13923 | 1 |
| 0.13924 | 1 |
| 0.13925 | 1 |
| 0.13926 | 1 |
| 0.13927 | 1 |
| 0.13928 | 1 |
| 0.13929 | 1 |
| 0.1393 | 1 |
| 0.13931 | 1 |
| 0.13932 | 1 |
| 0.13933 | 1 |
| 0.13934 | 1 |
| 0.13935 | 1 |
| 0.13936 | 1 |
| 0.13937 | 1 |
| 0.13938 | 1 |
| 0.13939 | 1 |
| 0.1394 | 1 |
| 0.13941 | 1 |
| 0.13942 | 1 |
| 0.13943 | 1 |
| 0.13944 | 1 |
| 0.13945 | 1 |
| 0.13946 | 1 |
| 0.13947 | 1 |
| 0.13948 | 1 |
| 0.13949 | 1 |
| 0.1395 | 1 |
| 0.13951 | 1 |
| 0.13952 | 1 |
| 0.13953 | 1 |
| 0.13954 | 1 |
| 0.13955 | 1 |
| 0.13956 | 1 |
| 0.13957 | 1 |
| 0.13958 | 1 |
| 0.13959 | 1 |
| 0.1396 | 1 |
| 0.13961 | 1 |
| 0.13962 | 1 |
| 0.13963 | 1 |
| 0.13964 | 1 |
| 0.13965 | 1 |
| 0.13966 | 1 |
| 0.13967 | 1 |
| 0.13968 | 1 |
| 0.13969 | 1 |
| 0.1397 | 1 |
| 0.13971 | 1 |
| 0.13972 | 1 |
| 0.13973 | 1 |
| 0.13974 | 1 |
| 0.13975 | 1 |
| 0.13976 | 1 |
| 0.13977 | 1 |
| 0.13978 | 1 |
| 0.13979 | 1 |
| 0.1398 | 1 |
| 0.13981 | 1 |
| 0.13982 | 1 |
| 0.13983 | 1 |
| 0.13984 | 1 |
| 0.13985 | 1 |
| 0.13986 | 1 |
| 0.13987 | 1 |
| 0.13988 | 1 |
| 0.13989 | 1 |
| 0.1399 | 1 |
| 0.13991 | 1 |
| 0.13992 | 1 |
| 0.13993 | 1 |
| 0.13994 | 1 |
| 0.13995 | 1 |
| 0.13996 | 1 |
| 0.13997 | 1 |
| 0.13998 | 1 |
| 0.13999 | 1 |
| 0.14 | 1 |
| 0.14001 | 1 |
| 0.14002 | 1 |
| 0.14003 | 1 |
| 0.14004 | 1 |
| 0.14005 | 1 |
| 0.14006 | 1 |
| 0.14007 | 1 |
| 0.14008 | 1 |
| 0.14009 | 1 |
| 0.1401 | 1 |
| 0.14011 | 1 |
| 0.14012 | 1 |
| 0.14013 | 1 |
| 0.14014 | 1 |
| 0.14015 | 1 |
| 0.14016 | 1 |
| 0.14017 | 1 |
| 0.14018 | 1 |
| 0.14019 | 1 |
| 0.1402 | 1 |
| 0.14021 | 1 |
| 0.14022 | 1 |
| 0.14023 | 1 |
| 0.14024 | 1 |
| 0.14025 | 1 |
| 0.14026 | 1 |
| 0.14027 | 1 |
| 0.14028 | 1 |
| 0.14029 | 1 |
| 0.1403 | 1 |
| 0.14031 | 1 |
| 0.14032 | 1 |
| 0.14033 | 1 |
| 0.14034 | 1 |
| 0.14035 | 1 |
| 0.14036 | 1 |
| 0.14037 | 1 |
| 0.14038 | 1 |
| 0.14039 | 1 |
| 0.1404 | 1 |
| 0.14041 | 1 |
| 0.14042 | 1 |
| 0.14043 | 1 |
| 0.14044 | 1 |
| 0.14045 | 1 |
| 0.14046 | 1 |
| 0.14047 | 1 |
| 0.14048 | 1 |
| 0.14049 | 1 |
| 0.1405 | 1 |
| 0.14051 | 1 |
| 0.14052 | 1 |
| 0.14053 | 1 |
| 0.14054 | 1 |
| 0.14055 | 1 |
| 0.14056 | 1 |
| 0.14057 | 1 |
| 0.14058 | 1 |
| 0.14059 | 1 |
| 0.1406 | 1 |
| 0.14061 | 1 |
| 0.14062 | 1 |
| 0.14063 | 1 |
| 0.14064 | 1 |
| 0.14065 | 1 |
| 0.14066 | 1 |
| 0.14067 | 1 |
| 0.14068 | 1 |
| 0.14069 | 1 |
| 0.1407 | 1 |
| 0.14071 | 1 |
| 0.14072 | 1 |
| 0.14073 | 1 |
| 0.14074 | 1 |
| 0.14075 | 1 |
| 0.14076 | 1 |
| 0.14077 | 1 |
| 0.14078 | 1 |
| 0.14079 | 1 |
| 0.1408 | 1 |
| 0.14081 | 1 |
| 0.14082 | 1 |
| 0.14083 | 1 |
| 0.14084 | 1 |
| 0.14085 | 1 |
| 0.14086 | 1 |
| 0.14087 | 1 |
| 0.14088 | 1 |
| 0.14089 | 1 |
| 0.1409 | 1 |
| 0.14091 | 1 |
| 0.14092 | 1 |
| 0.14093 | 1 |
| 0.14094 | 1 |
| 0.14095 | 1 |
| 0.14096 | 1 |
| 0.14097 | 1 |
| 0.14098 | 1 |
| 0.14099 | 1 |
| 0.141 | 1 |
| 0.14101 | 1 |
| 0.14102 | 1 |
| 0.14103 | 1 |
| 0.14104 | 1 |
| 0.14105 | 1 |
| 0.14106 | 1 |
| 0.14107 | 1 |
| 0.14108 | 1 |
| 0.14109 | 1 |
| 0.1411 | 1 |
| 0.14111 | 1 |
| 0.14112 | 1 |
| 0.14113 | 1 |
| 0.14114 | 1 |
| 0.14115 | 1 |
| 0.14116 | 1 |
| 0.14117 | 1 |
| 0.14118 | 1 |
| 0.14119 | 1 |
| 0.1412 | 1 |
| 0.14121 | 1 |
| 0.14122 | 1 |
| 0.14123 | 1 |
| 0.14124 | 1 |
| 0.14125 | 1 |
| 0.14126 | 1 |
| 0.14127 | 1 |
| 0.14128 | 1 |
| 0.14129 | 1 |
| 0.1413 | 1 |
| 0.14131 | 1 |
| 0.14132 | 1 |
| 0.14133 | 1 |
| 0.14134 | 1 |
| 0.14135 | 1 |
| 0.14136 | 1 |
| 0.14137 | 1 |
| 0.14138 | 1 |
| 0.14139 | 1 |
| 0.1414 | 1 |
| 0.14141 | 1 |
| 0.14142 | 1 |
| 0.14143 | 1 |
| 0.14144 | 1 |
| 0.14145 | 1 |
| 0.14146 | 1 |
| 0.14147 | 1 |
| 0.14148 | 1 |
| 0.14149 | 1 |
| 0.1415 | 1 |
| 0.14151 | 1 |
| 0.14152 | 1 |
| 0.14153 | 1 |
| 0.14154 | 1 |
| 0.14155 | 1 |
| 0.14156 | 1 |
| 0.14157 | 1 |
| 0.14158 | 1 |
| 0.14159 | 1 |
| 0.1416 | 1 |
| 0.14161 | 1 |
| 0.14162 | 1 |
| 0.14163 | 1 |
| 0.14164 | 1 |
| 0.14165 | 1 |
| 0.14166 | 1 |
| 0.14167 | 1 |
| 0.14168 | 1 |
| 0.14169 | 1 |
| 0.1417 | 1 |
| 0.14171 | 1 |
| 0.14172 | 1 |
| 0.14173 | 1 |
| 0.14174 | 1 |
| 0.14175 | 1 |
| 0.14176 | 1 |
| 0.14177 | 1 |
| 0.14178 | 1 |
| 0.14179 | 1 |
| 0.1418 | 1 |
| 0.14181 | 1 |
| 0.14182 | 1 |
| 0.14183 | 1 |
| 0.14184 | 1 |
| 0.14185 | 1 |
| 0.14186 | 1 |
| 0.14187 | 1 |
| 0.14188 | 1 |
| 0.14189 | 1 |
| 0.1419 | 1 |
| 0.14191 | 1 |
| 0.14192 | 1 |
| 0.14193 | 1 |
| 0.14194 | 1 |
| 0.14195 | 1 |
| 0.14196 | 1 |
| 0.14197 | 1 |
| 0.14198 | 1 |
| 0.14199 | 1 |
| 0.142 | 1 |
| 0.14201 | 1 |
| 0.14202 | 1 |
| 0.14203 | 1 |
| 0.14204 | 1 |
| 0.14205 | 1 |
| 0.14206 | 1 |
| 0.14207 | 1 |
| 0.14208 | 1 |
| 0.14209 | 1 |
| 0.1421 | 1 |
| 0.14211 | 1 |
| 0.14212 | 1 |
| 0.14213 | 1 |
| 0.14214 | 1 |
| 0.14215 | 1 |
| 0.14216 | 1 |
| 0.14217 | 1 |
| 0.14218 | 1 |
| 0.14219 | 1 |
| 0.1422 | 1 |
| 0.14221 | 1 |
| 0.14222 | 1 |
| 0.14223 | 1 |
| 0.14224 | 1 |
| 0.14225 | 1 |
| 0.14226 | 1 |
| 0.14227 | 1 |
| 0.14228 | 1 |
| 0.14229 | 1 |
| 0.1423 | 1 |
| 0.14231 | 1 |
| 0.14232 | 1 |
| 0.14233 | 1 |
| 0.14234 | 1 |
| 0.14235 | 1 |
| 0.14236 | 1 |
| 0.14237 | 1 |
| 0.14238 | 1 |
| 0.14239 | 1 |
| 0.1424 | 1 |
| 0.14241 | 1 |
| 0.14242 | 1 |
| 0.14243 | 1 |
| 0.14244 | 1 |
| 0.14245 | 1 |
| 0.14246 | 1 |
| 0.14247 | 1 |
| 0.14248 | 1 |
| 0.14249 | 1 |
| 0.1425 | 1 |
| 0.14251 | 1 |
| 0.14252 | 1 |
| 0.14253 | 1 |
| 0.14254 | 1 |
| 0.14255 | 1 |
| 0.14256 | 1 |
| 0.14257 | 1 |
| 0.14258 | 1 |
| 0.14259 | 1 |
| 0.1426 | 1 |
| 0.14261 | 1 |
| 0.14262 | 1 |
| 0.14263 | 1 |
| 0.14264 | 1 |
| 0.14265 | 1 |
| 0.14266 | 1 |
| 0.14267 | 1 |
| 0.14268 | 1 |
| 0.14269 | 1 |
| 0.1427 | 1 |
| 0.14271 | 1 |
| 0.14272 | 1 |
| 0.14273 | 1 |
| 0.14274 | 1 |
| 0.14275 | 1 |
| 0.14276 | 1 |
| 0.14277 | 1 |
| 0.14278 | 1 |
| 0.14279 | 1 |
| 0.1428 | 1 |
| 0.14281 | 1 |
| 0.14282 | 1 |
| 0.14283 | 1 |
| 0.14284 | 1 |
| 0.14285 | 1 |
| 0.14286 | 1 |
| 0.14287 | 1 |
| 0.14288 | 1 |
| 0.14289 | 1 |
| 0.1429 | 1 |
| 0.14291 | 1 |
| 0.14292 | 1 |
| 0.14293 | 1 |
| 0.14294 | 1 |
| 0.14295 | 1 |
| 0.14296 | 1 |
| 0.14297 | 1 |
| 0.14298 | 1 |
| 0.14299 | 1 |
| 0.143 | 1 |
| 0.14301 | 1 |
| 0.14302 | 1 |
| 0.14303 | 1 |
| 0.14304 | 1 |
| 0.14305 | 1 |
| 0.14306 | 1 |
| 0.14307 | 1 |
| 0.14308 | 1 |
| 0.14309 | 1 |
| 0.1431 | 1 |
| 0.14311 | 1 |
| 0.14312 | 1 |
| 0.14313 | 1 |
| 0.14314 | 1 |
| 0.14315 | 1 |
| 0.14316 | 1 |
| 0.14317 | 1 |
| 0.14318 | 1 |
| 0.14319 | 1 |
| 0.1432 | 1 |
| 0.14321 | 1 |
| 0.14322 | 1 |
| 0.14323 | 1 |
| 0.14324 | 1 |
| 0.14325 | 1 |
| 0.14326 | 1 |
| 0.14327 | 1 |
| 0.14328 | 1 |
| 0.14329 | 1 |
| 0.1433 | 1 |
| 0.14331 | 1 |
| 0.14332 | 1 |
| 0.14333 | 1 |
| 0.14334 | 1 |
| 0.14335 | 1 |
| 0.14336 | 1 |
| 0.14337 | 1 |
| 0.14338 | 1 |
| 0.14339 | 1 |
| 0.1434 | 1 |
| 0.14341 | 1 |
| 0.14342 | 1 |
| 0.14343 | 1 |
| 0.14344 | 1 |
| 0.14345 | 1 |
| 0.14346 | 1 |
| 0.14347 | 1 |
| 0.14348 | 1 |
| 0.14349 | 1 |
| 0.1435 | 1 |
| 0.14351 | 1 |
| 0.14352 | 1 |
| 0.14353 | 1 |
| 0.14354 | 1 |
| 0.14355 | 1 |
| 0.14356 | 1 |
| 0.14357 | 1 |
| 0.14358 | 1 |
| 0.14359 | 1 |
| 0.1436 | 1 |
| 0.14361 | 1 |
| 0.14362 | 1 |
| 0.14363 | 1 |
| 0.14364 | 1 |
| 0.14365 | 1 |
| 0.14366 | 1 |
| 0.14367 | 1 |
| 0.14368 | 1 |
| 0.14369 | 1 |
| 0.1437 | 1 |
| 0.14371 | 1 |
| 0.14372 | 1 |
| 0.14373 | 1 |
| 0.14374 | 1 |
| 0.14375 | 1 |
| 0.14376 | 1 |
| 0.14377 | 1 |
| 0.14378 | 1 |
| 0.14379 | 1 |
| 0.1438 | 1 |
| 0.14381 | 1 |
| 0.14382 | 1 |
| 0.14383 | 1 |
| 0.14384 | 1 |
| 0.14385 | 0.999 |
| 0.14386 | 0.999 |
| 0.14387 | 0.999 |
| 0.14388 | 0.999 |
| 0.14389 | 0.999 |
| 0.1439 | 0.999 |
| 0.14391 | 0.999 |
| 0.14392 | 0.999 |
| 0.14393 | 0.999 |
| 0.14394 | 0.999 |
| 0.14395 | 0.999 |
| 0.14396 | 0.999 |
| 0.14397 | 0.999 |
| 0.14398 | 0.999 |
| 0.14399 | 0.999 |
| 0.144 | 0.999 |
| 0.14401 | 0.999 |
| 0.14402 | 0.999 |
| 0.14403 | 0.999 |
| 0.14404 | 0.999 |
| 0.14405 | 0.999 |
| 0.14406 | 0.999 |
| 0.14407 | 0.999 |
| 0.14408 | 0.999 |
| 0.14409 | 0.999 |
| 0.1441 | 0.999 |
| 0.14411 | 0.999 |
| 0.14412 | 0.999 |
| 0.14413 | 0.999 |
| 0.14414 | 0.999 |
| 0.14415 | 0.999 |
| 0.14416 | 0.999 |
| 0.14417 | 0.999 |
| 0.14418 | 0.999 |
| 0.14419 | 0.999 |
| 0.1442 | 0.999 |
| 0.14421 | 0.999 |
| 0.14422 | 0.999 |
| 0.14423 | 0.999 |
| 0.14424 | 0.999 |
| 0.14425 | 0.999 |
| 0.14426 | 0.999 |
| 0.14427 | 0.999 |
| 0.14428 | 0.999 |
| 0.14429 | 0.999 |
| 0.1443 | 0.999 |
| 0.14431 | 0.999 |
| 0.14432 | 0.999 |
| 0.14433 | 0.999 |
| 0.14434 | 0.999 |
| 0.14435 | 0.999 |
| 0.14436 | 0.999 |
| 0.14437 | 0.999 |
| 0.14438 | 0.999 |
| 0.14439 | 0.999 |
| 0.1444 | 0.999 |
| 0.14441 | 0.999 |
| 0.14442 | 0.999 |
| 0.14443 | 0.999 |
| 0.14444 | 0.999 |
| 0.14445 | 0.999 |
| 0.14446 | 0.999 |
| 0.14447 | 0.999 |
| 0.14448 | 0.999 |
| 0.14449 | 0.999 |
| 0.1445 | 0.999 |
| 0.14451 | 0.999 |
| 0.14452 | 0.999 |
| 0.14453 | 0.999 |
| 0.14454 | 0.999 |
| 0.14455 | 0.999 |
| 0.14456 | 0.999 |
| 0.14457 | 0.999 |
| 0.14458 | 0.999 |
| 0.14459 | 0.999 |
| 0.1446 | 0.999 |
| 0.14461 | 0.999 |
| 0.14462 | 0.999 |
| 0.14463 | 0.999 |
| 0.14464 | 0.999 |
| 0.14465 | 0.999 |
| 0.14466 | 0.999 |
| 0.14467 | 0.999 |
| 0.14468 | 0.999 |
| 0.14469 | 0.999 |
| 0.1447 | 0.999 |
| 0.14471 | 0.999 |
| 0.14472 | 0.999 |
| 0.14473 | 0.999 |
| 0.14474 | 0.999 |
| 0.14475 | 0.999 |
| 0.14476 | 0.999 |
| 0.14477 | 0.999 |
| 0.14478 | 0.999 |
| 0.14479 | 0.999 |
| 0.1448 | 0.999 |
| 0.14481 | 0.999 |
| 0.14482 | 0.999 |
| 0.14483 | 0.999 |
| 0.14484 | 0.999 |
| 0.14485 | 0.999 |
| 0.14486 | 0.999 |
| 0.14487 | 0.999 |
| 0.14488 | 0.999 |
| 0.14489 | 0.999 |
| 0.1449 | 0.999 |
| 0.14491 | 0.999 |
| 0.14492 | 0.999 |
| 0.14493 | 0.999 |
| 0.14494 | 0.999 |
| 0.14495 | 0.999 |
| 0.14496 | 0.999 |
| 0.14497 | 0.999 |
| 0.14498 | 0.999 |
| 0.14499 | 0.999 |
| 0.145 | 0.999 |
| 0.14501 | 0.999 |
| 0.14502 | 0.999 |
| 0.14503 | 0.999 |
| 0.14504 | 0.999 |
| 0.14505 | 0.999 |
| 0.14506 | 0.999 |
| 0.14507 | 0.999 |
| 0.14508 | 0.999 |
| 0.14509 | 0.999 |
| 0.1451 | 0.999 |
| 0.14511 | 0.999 |
| 0.14512 | 0.999 |
| 0.14513 | 0.999 |
| 0.14514 | 0.999 |
| 0.14515 | 0.999 |
| 0.14516 | 0.999 |
| 0.14517 | 0.999 |
| 0.14518 | 0.999 |
| 0.14519 | 0.999 |
| 0.1452 | 0.999 |
| 0.14521 | 0.999 |
| 0.14522 | 0.999 |
| 0.14523 | 0.999 |
| 0.14524 | 0.999 |
| 0.14525 | 0.999 |
| 0.14526 | 0.999 |
| 0.14527 | 0.999 |
| 0.14528 | 0.999 |
| 0.14529 | 0.999 |
| 0.1453 | 0.999 |
| 0.14531 | 0.999 |
| 0.14532 | 0.999 |
| 0.14533 | 0.999 |
| 0.14534 | 0.999 |
| 0.14535 | 0.999 |
| 0.14536 | 0.999 |
| 0.14537 | 0.999 |
| 0.14538 | 0.999 |
| 0.14539 | 0.999 |
| 0.1454 | 0.999 |
| 0.14541 | 0.999 |
| 0.14542 | 0.999 |
| 0.14543 | 0.999 |
| 0.14544 | 0.999 |
| 0.14545 | 0.999 |
| 0.14546 | 0.999 |
| 0.14547 | 0.999 |
| 0.14548 | 0.999 |
| 0.14549 | 0.999 |
| 0.1455 | 0.999 |
| 0.14551 | 0.999 |
| 0.14552 | 0.999 |
| 0.14553 | 0.999 |
| 0.14554 | 0.999 |
| 0.14555 | 0.999 |
| 0.14556 | 0.999 |
| 0.14557 | 0.999 |
| 0.14558 | 0.999 |
| 0.14559 | 0.999 |
| 0.1456 | 0.999 |
| 0.14561 | 0.999 |
| 0.14562 | 0.999 |
| 0.14563 | 0.999 |
| 0.14564 | 0.999 |
| 0.14565 | 0.999 |
| 0.14566 | 0.999 |
| 0.14567 | 0.999 |
| 0.14568 | 0.999 |
| 0.14569 | 0.999 |
| 0.1457 | 0.999 |
| 0.14571 | 0.999 |
| 0.14572 | 0.999 |
| 0.14573 | 0.999 |
| 0.14574 | 0.999 |
| 0.14575 | 0.999 |
| 0.14576 | 0.999 |
| 0.14577 | 0.999 |
| 0.14578 | 0.999 |
| 0.14579 | 0.999 |
| 0.1458 | 0.999 |
| 0.14581 | 0.999 |
| 0.14582 | 0.999 |
| 0.14583 | 0.999 |
| 0.14584 | 0.999 |
| 0.14585 | 0.999 |
| 0.14586 | 0.999 |
| 0.14587 | 0.999 |
| 0.14588 | 0.999 |
| 0.14589 | 0.999 |
| 0.1459 | 0.999 |
| 0.14591 | 0.999 |
| 0.14592 | 0.999 |
| 0.14593 | 0.999 |
| 0.14594 | 0.999 |
| 0.14595 | 0.999 |
| 0.14596 | 0.999 |
| 0.14597 | 0.999 |
| 0.14598 | 0.999 |
| 0.14599 | 0.999 |
| 0.146 | 0.999 |
| 0.14601 | 0.999 |
| 0.14602 | 0.999 |
| 0.14603 | 0.999 |
| 0.14604 | 0.999 |
| 0.14605 | 0.999 |
| 0.14606 | 0.999 |
| 0.14607 | 0.999 |
| 0.14608 | 0.999 |
| 0.14609 | 0.999 |
| 0.1461 | 0.999 |
| 0.14611 | 0.999 |
| 0.14612 | 0.999 |
| 0.14613 | 0.999 |
| 0.14614 | 0.999 |
| 0.14615 | 0.999 |
| 0.14616 | 0.999 |
| 0.14617 | 0.999 |
| 0.14618 | 0.999 |
| 0.14619 | 0.999 |
| 0.1462 | 0.999 |
| 0.14621 | 0.999 |
| 0.14622 | 0.999 |
| 0.14623 | 0.999 |
| 0.14624 | 0.999 |
| 0.14625 | 0.999 |
| 0.14626 | 0.999 |
| 0.14627 | 0.999 |
| 0.14628 | 0.999 |
| 0.14629 | 0.999 |
| 0.1463 | 0.999 |
| 0.14631 | 0.999 |
| 0.14632 | 0.999 |
| 0.14633 | 0.999 |
| 0.14634 | 0.999 |
| 0.14635 | 0.999 |
| 0.14636 | 0.999 |
| 0.14637 | 0.999 |
| 0.14638 | 0.999 |
| 0.14639 | 0.999 |
| 0.1464 | 0.999 |
| 0.14641 | 0.999 |
| 0.14642 | 0.999 |
| 0.14643 | 0.999 |
| 0.14644 | 0.999 |
| 0.14645 | 0.999 |
| 0.14646 | 0.999 |
| 0.14647 | 0.999 |
| 0.14648 | 0.999 |
| 0.14649 | 0.999 |
| 0.1465 | 0.999 |
| 0.14651 | 0.999 |
| 0.14652 | 0.999 |
| 0.14653 | 0.999 |
| 0.14654 | 0.999 |
| 0.14655 | 0.999 |
| 0.14656 | 0.999 |
| 0.14657 | 0.999 |
| 0.14658 | 0.999 |
| 0.14659 | 0.999 |
| 0.1466 | 0.999 |
| 0.14661 | 0.999 |
| 0.14662 | 0.999 |
| 0.14663 | 0.999 |
| 0.14664 | 0.999 |
| 0.14665 | 0.999 |
| 0.14666 | 0.999 |
| 0.14667 | 0.999 |
| 0.14668 | 0.999 |
| 0.14669 | 0.999 |
| 0.1467 | 0.999 |
| 0.14671 | 0.999 |
| 0.14672 | 0.999 |
| 0.14673 | 0.999 |
| 0.14674 | 0.999 |
| 0.14675 | 0.999 |
| 0.14676 | 0.999 |
| 0.14677 | 0.999 |
| 0.14678 | 0.999 |
| 0.14679 | 0.999 |
| 0.1468 | 0.999 |
| 0.14681 | 0.999 |
| 0.14682 | 0.999 |
| 0.14683 | 0.999 |
| 0.14684 | 0.999 |
| 0.14685 | 0.999 |
| 0.14686 | 0.999 |
| 0.14687 | 0.999 |
| 0.14688 | 0.999 |
| 0.14689 | 0.999 |
| 0.1469 | 0.999 |
| 0.14691 | 0.999 |
| 0.14692 | 0.999 |
| 0.14693 | 0.999 |
| 0.14694 | 0.999 |
| 0.14695 | 0.999 |
| 0.14696 | 0.999 |
| 0.14697 | 0.999 |
| 0.14698 | 0.999 |
| 0.14699 | 0.999 |
| 0.147 | 0.999 |
| 0.14701 | 0.999 |
| 0.14702 | 0.999 |
| 0.14703 | 0.999 |
| 0.14704 | 0.999 |
| 0.14705 | 0.999 |
| 0.14706 | 0.999 |
| 0.14707 | 0.999 |
| 0.14708 | 0.999 |
| 0.14709 | 0.999 |
| 0.1471 | 0.999 |
| 0.14711 | 0.999 |
| 0.14712 | 0.999 |
| 0.14713 | 0.999 |
| 0.14714 | 0.999 |
| 0.14715 | 0.999 |
| 0.14716 | 0.999 |
| 0.14717 | 0.999 |
| 0.14718 | 0.999 |
| 0.14719 | 0.999 |
| 0.1472 | 0.999 |
| 0.14721 | 0.999 |
| 0.14722 | 0.999 |
| 0.14723 | 0.999 |
| 0.14724 | 0.999 |
| 0.14725 | 0.999 |
| 0.14726 | 0.999 |
| 0.14727 | 0.999 |
| 0.14728 | 0.999 |
| 0.14729 | 0.999 |
| 0.1473 | 0.999 |
| 0.14731 | 0.999 |
| 0.14732 | 0.999 |
| 0.14733 | 0.999 |
| 0.14734 | 0.999 |
| 0.14735 | 0.999 |
| 0.14736 | 0.999 |
| 0.14737 | 0.999 |
| 0.14738 | 0.999 |
| 0.14739 | 0.999 |
| 0.1474 | 0.999 |
| 0.14741 | 0.999 |
| 0.14742 | 0.999 |
| 0.14743 | 0.999 |
| 0.14744 | 0.999 |
| 0.14745 | 0.999 |
| 0.14746 | 0.999 |
| 0.14747 | 0.999 |
| 0.14748 | 0.999 |
| 0.14749 | 0.999 |
| 0.1475 | 0.999 |
| 0.14751 | 0.999 |
| 0.14752 | 0.999 |
| 0.14753 | 0.999 |
| 0.14754 | 0.999 |
| 0.14755 | 0.999 |
| 0.14756 | 0.999 |
| 0.14757 | 0.999 |
| 0.14758 | 0.999 |
| 0.14759 | 0.999 |
| 0.1476 | 0.999 |
| 0.14761 | 0.999 |
| 0.14762 | 0.999 |
| 0.14763 | 0.999 |
| 0.14764 | 0.999 |
| 0.14765 | 0.999 |
| 0.14766 | 0.999 |
| 0.14767 | 0.999 |
| 0.14768 | 0.999 |
| 0.14769 | 0.999 |
| 0.1477 | 0.999 |
| 0.14771 | 0.999 |
| 0.14772 | 0.999 |
| 0.14773 | 0.999 |
| 0.14774 | 0.999 |
| 0.14775 | 0.999 |
| 0.14776 | 0.999 |
| 0.14777 | 0.999 |
| 0.14778 | 0.999 |
| 0.14779 | 0.999 |
| 0.1478 | 0.999 |
| 0.14781 | 0.999 |
| 0.14782 | 0.999 |
| 0.14783 | 0.999 |
| 0.14784 | 0.999 |
| 0.14785 | 0.999 |
| 0.14786 | 0.999 |
| 0.14787 | 0.999 |
| 0.14788 | 0.999 |
| 0.14789 | 0.999 |
| 0.1479 | 0.999 |
| 0.14791 | 0.999 |
| 0.14792 | 0.999 |
| 0.14793 | 0.999 |
| 0.14794 | 0.999 |
| 0.14795 | 0.999 |
| 0.14796 | 0.999 |
| 0.14797 | 0.999 |
| 0.14798 | 0.999 |
| 0.14799 | 0.999 |
| 0.148 | 0.999 |
| 0.14801 | 0.999 |
| 0.14802 | 0.999 |
| 0.14803 | 0.999 |
| 0.14804 | 0.999 |
| 0.14805 | 0.999 |
| 0.14806 | 0.999 |
| 0.14807 | 0.999 |
| 0.14808 | 0.999 |
| 0.14809 | 0.999 |
| 0.1481 | 0.999 |
| 0.14811 | 0.999 |
| 0.14812 | 0.999 |
| 0.14813 | 0.999 |
| 0.14814 | 0.999 |
| 0.14815 | 0.999 |
| 0.14816 | 0.999 |
| 0.14817 | 0.999 |
| 0.14818 | 0.999 |
| 0.14819 | 0.999 |
| 0.1482 | 0.999 |
| 0.14821 | 0.999 |
| 0.14822 | 0.999 |
| 0.14823 | 0.999 |
| 0.14824 | 0.999 |
| 0.14825 | 0.999 |
| 0.14826 | 0.999 |
| 0.14827 | 0.999 |
| 0.14828 | 0.999 |
| 0.14829 | 0.999 |
| 0.1483 | 0.999 |
| 0.14831 | 0.999 |
| 0.14832 | 0.999 |
| 0.14833 | 0.999 |
| 0.14834 | 0.999 |
| 0.14835 | 0.999 |
| 0.14836 | 0.999 |
| 0.14837 | 0.999 |
| 0.14838 | 0.999 |
| 0.14839 | 0.999 |
| 0.1484 | 0.999 |
| 0.14841 | 0.999 |
| 0.14842 | 0.999 |
| 0.14843 | 0.999 |
| 0.14844 | 0.999 |
| 0.14845 | 0.999 |
| 0.14846 | 0.999 |
| 0.14847 | 0.999 |
| 0.14848 | 0.999 |
| 0.14849 | 0.999 |
| 0.1485 | 0.999 |
| 0.14851 | 0.999 |
| 0.14852 | 0.999 |
| 0.14853 | 0.999 |
| 0.14854 | 0.999 |
| 0.14855 | 0.999 |
| 0.14856 | 0.999 |
| 0.14857 | 0.999 |
| 0.14858 | 0.999 |
| 0.14859 | 0.999 |
| 0.1486 | 0.999 |
| 0.14861 | 0.999 |
| 0.14862 | 0.999 |
| 0.14863 | 0.999 |
| 0.14864 | 0.999 |
| 0.14865 | 0.999 |
| 0.14866 | 0.999 |
| 0.14867 | 0.999 |
| 0.14868 | 0.999 |
| 0.14869 | 0.999 |
| 0.1487 | 0.999 |
| 0.14871 | 0.999 |
| 0.14872 | 0.999 |
| 0.14873 | 0.999 |
| 0.14874 | 0.999 |
| 0.14875 | 0.999 |
| 0.14876 | 0.999 |
| 0.14877 | 0.999 |
| 0.14878 | 0.999 |
| 0.14879 | 0.999 |
| 0.1488 | 0.999 |
| 0.14881 | 0.999 |
| 0.14882 | 0.999 |
| 0.14883 | 0.999 |
| 0.14884 | 0.999 |
| 0.14885 | 0.999 |
| 0.14886 | 0.999 |
| 0.14887 | 0.999 |
| 0.14888 | 0.999 |
| 0.14889 | 0.999 |
| 0.1489 | 0.999 |
| 0.14891 | 0.999 |
| 0.14892 | 0.999 |
| 0.14893 | 0.999 |
| 0.14894 | 0.999 |
| 0.14895 | 0.999 |
| 0.14896 | 0.999 |
| 0.14897 | 0.999 |
| 0.14898 | 0.999 |
| 0.14899 | 0.999 |
| 0.149 | 0.999 |
| 0.14901 | 0.999 |
| 0.14902 | 0.999 |
| 0.14903 | 0.999 |
| 0.14904 | 0.999 |
| 0.14905 | 0.999 |
| 0.14906 | 0.999 |
| 0.14907 | 0.999 |
| 0.14908 | 0.999 |
| 0.14909 | 0.999 |
| 0.1491 | 0.999 |
| 0.14911 | 0.999 |
| 0.14912 | 0.999 |
| 0.14913 | 0.999 |
| 0.14914 | 0.999 |
| 0.14915 | 0.999 |
| 0.14916 | 0.999 |
| 0.14917 | 0.999 |
| 0.14918 | 0.999 |
| 0.14919 | 0.999 |
| 0.1492 | 0.999 |
| 0.14921 | 0.999 |
| 0.14922 | 0.999 |
| 0.14923 | 0.999 |
| 0.14924 | 0.999 |
| 0.14925 | 0.999 |
| 0.14926 | 0.999 |
| 0.14927 | 0.999 |
| 0.14928 | 0.999 |
| 0.14929 | 0.999 |
| 0.1493 | 0.999 |
| 0.14931 | 0.999 |
| 0.14932 | 0.999 |
| 0.14933 | 0.999 |
| 0.14934 | 0.999 |
| 0.14935 | 0.999 |
| 0.14936 | 0.999 |
| 0.14937 | 0.999 |
| 0.14938 | 0.999 |
| 0.14939 | 0.999 |
| 0.1494 | 0.999 |
| 0.14941 | 0.999 |
| 0.14942 | 0.999 |
| 0.14943 | 0.999 |
| 0.14944 | 0.999 |
| 0.14945 | 0.999 |
| 0.14946 | 0.999 |
| 0.14947 | 0.999 |
| 0.14948 | 0.999 |
| 0.14949 | 0.999 |
| 0.1495 | 0.999 |
| 0.14951 | 0.999 |
| 0.14952 | 0.999 |
| 0.14953 | 0.999 |
| 0.14954 | 0.999 |
| 0.14955 | 0.999 |
| 0.14956 | 0.999 |
| 0.14957 | 0.999 |
| 0.14958 | 0.999 |
| 0.14959 | 0.999 |
| 0.1496 | 0.999 |
| 0.14961 | 0.999 |
| 0.14962 | 0.999 |
| 0.14963 | 0.999 |
| 0.14964 | 0.999 |
| 0.14965 | 0.999 |
| 0.14966 | 0.999 |
| 0.14967 | 0.999 |
| 0.14968 | 0.999 |
| 0.14969 | 0.999 |
| 0.1497 | 0.999 |
| 0.14971 | 0.999 |
| 0.14972 | 0.999 |
| 0.14973 | 1 |
| 0.14974 | 1 |
| 0.14975 | 1 |
| 0.14976 | 1 |
| 0.14977 | 1 |
| 0.14978 | 1 |
| 0.14979 | 1 |
| 0.1498 | 1 |
| 0.14981 | 1 |
| 0.14982 | 1 |
| 0.14983 | 1 |
| 0.14984 | 1 |
| 0.14985 | 1 |
| 0.14986 | 1 |
| 0.14987 | 1 |
| 0.14988 | 1 |
| 0.14989 | 1 |
| 0.1499 | 1 |
| 0.14991 | 1 |
| 0.14992 | 1 |
| 0.14993 | 1 |
| 0.14994 | 1 |
| 0.14995 | 1 |
| 0.14996 | 1 |
| 0.14997 | 1 |
| 0.14998 | 1 |
| 0.14999 | 1 |
| 0.15 | 1 |
| 0.15001 | 1 |
| 0.15002 | 1 |
| 0.15003 | 1 |
| 0.15004 | 1 |
| 0.15005 | 1 |
| 0.15006 | 1 |
| 0.15007 | 1 |
| 0.15008 | 1 |
| 0.15009 | 1 |
| 0.1501 | 1 |
| 0.15011 | 1 |
| 0.15012 | 1 |
| 0.15013 | 1 |
| 0.15014 | 1 |
| 0.15015 | 1 |
| 0.15016 | 1 |
| 0.15017 | 1 |
| 0.15018 | 1 |
| 0.15019 | 1 |
| 0.1502 | 1 |
| 0.15021 | 1 |
| 0.15022 | 1 |
| 0.15023 | 1 |
| 0.15024 | 1 |
| 0.15025 | 1 |
| 0.15026 | 1 |
| 0.15027 | 1 |
| 0.15028 | 1 |
| 0.15029 | 1 |
| 0.1503 | 1 |
| 0.15031 | 1 |
| 0.15032 | 1 |
| 0.15033 | 1 |
| 0.15034 | 1 |
| 0.15035 | 1 |
| 0.15036 | 1 |
| 0.15037 | 1 |
| 0.15038 | 1 |
| 0.15039 | 1 |
| 0.1504 | 1 |
| 0.15041 | 1 |
| 0.15042 | 1 |
| 0.15043 | 1 |
| 0.15044 | 1 |
| 0.15045 | 1 |
| 0.15046 | 1 |
| 0.15047 | 1 |
| 0.15048 | 1 |
| 0.15049 | 1 |
| 0.1505 | 1 |
| 0.15051 | 1 |
| 0.15052 | 1 |
| 0.15053 | 1 |
| 0.15054 | 1 |
| 0.15055 | 1 |
| 0.15056 | 1 |
| 0.15057 | 1 |
| 0.15058 | 1 |
| 0.15059 | 1 |
| 0.1506 | 1 |
| 0.15061 | 1 |
| 0.15062 | 1 |
| 0.15063 | 1 |
| 0.15064 | 1 |
| 0.15065 | 1 |
| 0.15066 | 1 |
| 0.15067 | 1 |
| 0.15068 | 1 |
| 0.15069 | 1 |
| 0.1507 | 1 |
| 0.15071 | 1 |
| 0.15072 | 1 |
| 0.15073 | 1 |
| 0.15074 | 1 |
| 0.15075 | 1 |
| 0.15076 | 1 |
| 0.15077 | 1 |
| 0.15078 | 1 |
| 0.15079 | 1 |
| 0.1508 | 1 |
| 0.15081 | 1 |
| 0.15082 | 1 |
| 0.15083 | 1 |
| 0.15084 | 1 |
| 0.15085 | 1 |
| 0.15086 | 1 |
| 0.15087 | 1 |
| 0.15088 | 1 |
| 0.15089 | 1 |
| 0.1509 | 1 |
| 0.15091 | 1 |
| 0.15092 | 1 |
| 0.15093 | 1 |
| 0.15094 | 1 |
| 0.15095 | 1 |
| 0.15096 | 1 |
| 0.15097 | 1 |
| 0.15098 | 1 |
| 0.15099 | 1 |
| 0.151 | 1 |
| 0.15101 | 1 |
| 0.15102 | 1 |
| 0.15103 | 1 |
| 0.15104 | 1 |
| 0.15105 | 1 |
| 0.15106 | 1 |
| 0.15107 | 1 |
| 0.15108 | 1 |
| 0.15109 | 1 |
| 0.1511 | 1 |
| 0.15111 | 1 |
| 0.15112 | 1 |
| 0.15113 | 1 |
| 0.15114 | 1 |
| 0.15115 | 1 |
| 0.15116 | 1 |
| 0.15117 | 1 |
| 0.15118 | 1 |
| 0.15119 | 1 |
| 0.1512 | 1 |
| 0.15121 | 1 |
| 0.15122 | 1 |
| 0.15123 | 1 |
| 0.15124 | 1 |
| 0.15125 | 1 |
| 0.15126 | 1 |
| 0.15127 | 1 |
| 0.15128 | 1 |
| 0.15129 | 1 |
| 0.1513 | 1 |
| 0.15131 | 1 |
| 0.15132 | 1 |
| 0.15133 | 1 |
| 0.15134 | 1 |
| 0.15135 | 1 |
| 0.15136 | 1 |
| 0.15137 | 1 |
| 0.15138 | 1 |
| 0.15139 | 1 |
| 0.1514 | 1 |
| 0.15141 | 1 |
| 0.15142 | 1 |
| 0.15143 | 1 |
| 0.15144 | 1 |
| 0.15145 | 1 |
| 0.15146 | 1 |
| 0.15147 | 1 |
| 0.15148 | 1 |
| 0.15149 | 1 |
| 0.1515 | 1 |
| 0.15151 | 1 |
| 0.15152 | 1 |
| 0.15153 | 1 |
| 0.15154 | 1 |
| 0.15155 | 1 |
| 0.15156 | 1 |
| 0.15157 | 1 |
| 0.15158 | 1 |
| 0.15159 | 1 |
| 0.1516 | 1 |
| 0.15161 | 1 |
| 0.15162 | 1 |
| 0.15163 | 1 |
| 0.15164 | 1 |
| 0.15165 | 1 |
| 0.15166 | 1 |
| 0.15167 | 1 |
| 0.15168 | 1 |
| 0.15169 | 1 |
| 0.1517 | 1 |
| 0.15171 | 1 |
| 0.15172 | 1 |
| 0.15173 | 1 |
| 0.15174 | 1 |
| 0.15175 | 1 |
| 0.15176 | 1 |
| 0.15177 | 1 |
| 0.15178 | 1 |
| 0.15179 | 1 |
| 0.1518 | 1 |
| 0.15181 | 1 |
| 0.15182 | 1 |
| 0.15183 | 1 |
| 0.15184 | 1 |
| 0.15185 | 1 |
| 0.15186 | 1 |
| 0.15187 | 1 |
| 0.15188 | 1 |
| 0.15189 | 1 |
| 0.1519 | 1 |
| 0.15191 | 1 |
| 0.15192 | 1 |
| 0.15193 | 1 |
| 0.15194 | 1 |
| 0.15195 | 1 |
| 0.15196 | 1 |
| 0.15197 | 1 |
| 0.15198 | 1 |
| 0.15199 | 1 |
| 0.152 | 1 |
| 0.15201 | 1 |
| 0.15202 | 1 |
| 0.15203 | 1 |
| 0.15204 | 1 |
| 0.15205 | 1 |
| 0.15206 | 1 |
| 0.15207 | 1 |
| 0.15208 | 1 |
| 0.15209 | 1 |
| 0.1521 | 1 |
| 0.15211 | 1 |
| 0.15212 | 1 |
| 0.15213 | 1 |
| 0.15214 | 1 |
| 0.15215 | 1 |
| 0.15216 | 1 |
| 0.15217 | 1 |
| 0.15218 | 1 |
| 0.15219 | 1 |
| 0.1522 | 1 |
| 0.15221 | 1 |
| 0.15222 | 1 |
| 0.15223 | 1 |
| 0.15224 | 1 |
| 0.15225 | 1 |
| 0.15226 | 1 |
| 0.15227 | 1 |
| 0.15228 | 1 |
| 0.15229 | 1 |
| 0.1523 | 1 |
| 0.15231 | 1 |
| 0.15232 | 1 |
| 0.15233 | 1 |
| 0.15234 | 1 |
| 0.15235 | 1 |
| 0.15236 | 1 |
| 0.15237 | 1 |
| 0.15238 | 1 |
| 0.15239 | 1 |
| 0.1524 | 1 |
| 0.15241 | 1 |
| 0.15242 | 1 |
| 0.15243 | 1 |
| 0.15244 | 1 |
| 0.15245 | 1 |
| 0.15246 | 1 |
| 0.15247 | 1 |
| 0.15248 | 1 |
| 0.15249 | 1 |
| 0.1525 | 1 |
| 0.15251 | 1 |
| 0.15252 | 1 |
| 0.15253 | 1 |
| 0.15254 | 1 |
| 0.15255 | 1 |
| 0.15256 | 1 |
| 0.15257 | 1 |
| 0.15258 | 1 |
| 0.15259 | 1 |
| 0.1526 | 1 |
| 0.15261 | 1 |
| 0.15262 | 1 |
| 0.15263 | 1 |
| 0.15264 | 1 |
| 0.15265 | 1 |
| 0.15266 | 1 |
| 0.15267 | 1 |
| 0.15268 | 1 |
| 0.15269 | 1 |
| 0.1527 | 1 |
| 0.15271 | 1 |
| 0.15272 | 1 |
| 0.15273 | 1 |
| 0.15274 | 1 |
| 0.15275 | 1 |
| 0.15276 | 1 |
| 0.15277 | 1 |
| 0.15278 | 1 |
| 0.15279 | 1 |
| 0.1528 | 1 |
| 0.15281 | 1 |
| 0.15282 | 1 |
| 0.15283 | 1 |
| 0.15284 | 1 |
| 0.15285 | 1 |
| 0.15286 | 1 |
| 0.15287 | 1 |
| 0.15288 | 1 |
| 0.15289 | 1 |
| 0.1529 | 1 |
| 0.15291 | 1 |
| 0.15292 | 1 |
| 0.15293 | 1 |
| 0.15294 | 1 |
| 0.15295 | 1 |
| 0.15296 | 1 |
| 0.15297 | 1 |
| 0.15298 | 1 |
| 0.15299 | 1 |
| 0.153 | 1 |
| 0.15301 | 1 |
| 0.15302 | 1 |
| 0.15303 | 1 |
| 0.15304 | 1 |
| 0.15305 | 1 |
| 0.15306 | 1 |
| 0.15307 | 1 |
| 0.15308 | 1 |
| 0.15309 | 1 |
| 0.1531 | 1 |
| 0.15311 | 1 |
| 0.15312 | 1 |
| 0.15313 | 1 |
| 0.15314 | 1 |
| 0.15315 | 1 |
| 0.15316 | 1 |
| 0.15317 | 1 |
| 0.15318 | 1 |
| 0.15319 | 1 |
| 0.1532 | 1 |
| 0.15321 | 1 |
| 0.15322 | 1 |
| 0.15323 | 1 |
| 0.15324 | 1 |
| 0.15325 | 1 |
| 0.15326 | 1 |
| 0.15327 | 1 |
| 0.15328 | 1 |
| 0.15329 | 1 |
| 0.1533 | 1 |
| 0.15331 | 1 |
| 0.15332 | 1 |
| 0.15333 | 1 |
| 0.15334 | 1 |
| 0.15335 | 1 |
| 0.15336 | 1 |
| 0.15337 | 1 |
| 0.15338 | 1 |
| 0.15339 | 1 |
| 0.1534 | 1 |
| 0.15341 | 1 |
| 0.15342 | 1 |
| 0.15343 | 1 |
| 0.15344 | 1 |
| 0.15345 | 1 |
| 0.15346 | 1 |
| 0.15347 | 1 |
| 0.15348 | 1 |
| 0.15349 | 1 |
| 0.1535 | 1 |
| 0.15351 | 1 |
| 0.15352 | 1 |
| 0.15353 | 1 |
| 0.15354 | 1 |
| 0.15355 | 1 |
| 0.15356 | 1 |
| 0.15357 | 1 |
| 0.15358 | 1 |
| 0.15359 | 1 |
| 0.1536 | 1 |
| 0.15361 | 1 |
| 0.15362 | 1 |
| 0.15363 | 1 |
| 0.15364 | 1 |
| 0.15365 | 1 |
| 0.15366 | 1 |
| 0.15367 | 1 |
| 0.15368 | 1 |
| 0.15369 | 1 |
| 0.1537 | 1 |
| 0.15371 | 1 |
| 0.15372 | 1 |
| 0.15373 | 1 |
| 0.15374 | 1 |
| 0.15375 | 1 |
| 0.15376 | 1 |
| 0.15377 | 1 |
| 0.15378 | 1 |
| 0.15379 | 1 |
| 0.1538 | 1 |
| 0.15381 | 1 |
| 0.15382 | 1 |
| 0.15383 | 1 |
| 0.15384 | 1 |
| 0.15385 | 1 |
| 0.15386 | 1 |
| 0.15387 | 1 |
| 0.15388 | 1 |
| 0.15389 | 1 |
| 0.1539 | 1 |
| 0.15391 | 1 |
| 0.15392 | 1 |
| 0.15393 | 1 |
| 0.15394 | 1 |
| 0.15395 | 1 |
| 0.15396 | 1 |
| 0.15397 | 1 |
| 0.15398 | 1 |
| 0.15399 | 1 |
| 0.154 | 1 |
| 0.15401 | 1 |
| 0.15402 | 1 |
| 0.15403 | 1 |
| 0.15404 | 1 |
| 0.15405 | 1 |
| 0.15406 | 1 |
| 0.15407 | 1 |
| 0.15408 | 1 |
| 0.15409 | 1 |
| 0.1541 | 1 |
| 0.15411 | 1 |
| 0.15412 | 1 |
| 0.15413 | 1 |
| 0.15414 | 1 |
| 0.15415 | 1 |
| 0.15416 | 1 |
| 0.15417 | 1 |
| 0.15418 | 1 |
| 0.15419 | 1 |
| 0.1542 | 1 |
| 0.15421 | 1 |
| 0.15422 | 1 |
| 0.15423 | 1 |
| 0.15424 | 1 |
| 0.15425 | 1 |
| 0.15426 | 1 |
| 0.15427 | 1 |
| 0.15428 | 1 |
| 0.15429 | 1 |
| 0.1543 | 1 |
| 0.15431 | 1 |
| 0.15432 | 1 |
| 0.15433 | 1 |
| 0.15434 | 1 |
| 0.15435 | 1 |
| 0.15436 | 1 |
| 0.15437 | 1 |
| 0.15438 | 1 |
| 0.15439 | 1 |
| 0.1544 | 1 |
| 0.15441 | 1 |
| 0.15442 | 1 |
| 0.15443 | 1 |
| 0.15444 | 1 |
| 0.15445 | 1 |
| 0.15446 | 1 |
| 0.15447 | 1 |
| 0.15448 | 1 |
| 0.15449 | 1 |
| 0.1545 | 1 |
| 0.15451 | 1 |
| 0.15452 | 1 |
| 0.15453 | 1 |
| 0.15454 | 1 |
| 0.15455 | 1 |
| 0.15456 | 1 |
| 0.15457 | 1 |
| 0.15458 | 1 |
| 0.15459 | 1 |
| 0.1546 | 1 |
| 0.15461 | 1 |
| 0.15462 | 1 |
| 0.15463 | 1 |
| 0.15464 | 1 |
| 0.15465 | 1 |
| 0.15466 | 1 |
| 0.15467 | 1 |
| 0.15468 | 1 |
| 0.15469 | 1 |
| 0.1547 | 1 |
| 0.15471 | 1 |
| 0.15472 | 1 |
| 0.15473 | 1 |
| 0.15474 | 1 |
| 0.15475 | 1 |
| 0.15476 | 1 |
| 0.15477 | 1 |
| 0.15478 | 1 |
| 0.15479 | 1 |
| 0.1548 | 1 |
| 0.15481 | 1 |
| 0.15482 | 1 |
| 0.15483 | 1 |
| 0.15484 | 1 |
| 0.15485 | 1 |
| 0.15486 | 1 |
| 0.15487 | 1 |
| 0.15488 | 1 |
| 0.15489 | 1 |
| 0.1549 | 1 |
| 0.15491 | 1 |
| 0.15492 | 1 |
| 0.15493 | 1 |
| 0.15494 | 1 |
| 0.15495 | 1 |
| 0.15496 | 1 |
| 0.15497 | 1 |
| 0.15498 | 1 |
| 0.15499 | 1 |
| 0.155 | 1 |
| 0.15501 | 1 |
| 0.15502 | 1 |
| 0.15503 | 1 |
| 0.15504 | 1 |
| 0.15505 | 1 |
| 0.15506 | 1 |
| 0.15507 | 1 |
| 0.15508 | 1 |
| 0.15509 | 1 |
| 0.1551 | 1 |
| 0.15511 | 1 |
| 0.15512 | 1 |
| 0.15513 | 1 |
| 0.15514 | 1 |
| 0.15515 | 1 |
| 0.15516 | 1 |
| 0.15517 | 1 |
| 0.15518 | 1 |
| 0.15519 | 1 |
| 0.1552 | 1 |
| 0.15521 | 1 |
| 0.15522 | 1 |
| 0.15523 | 1 |
| 0.15524 | 1 |
| 0.15525 | 1 |
| 0.15526 | 1 |
| 0.15527 | 1 |
| 0.15528 | 1 |
| 0.15529 | 1 |
| 0.1553 | 1 |
| 0.15531 | 1 |
| 0.15532 | 1 |
| 0.15533 | 1 |
| 0.15534 | 1 |
| 0.15535 | 1 |
| 0.15536 | 1 |
| 0.15537 | 1 |
| 0.15538 | 1 |
| 0.15539 | 1 |
| 0.1554 | 1 |
| 0.15541 | 1 |
| 0.15542 | 1 |
| 0.15543 | 1 |
| 0.15544 | 1 |
| 0.15545 | 1 |
| 0.15546 | 1 |
| 0.15547 | 1 |
| 0.15548 | 1 |
| 0.15549 | 1 |
| 0.1555 | 1 |
| 0.15551 | 1 |
| 0.15552 | 1 |
| 0.15553 | 1 |
| 0.15554 | 1 |
| 0.15555 | 1 |
| 0.15556 | 1 |
| 0.15557 | 1 |
| 0.15558 | 1 |
| 0.15559 | 1 |
| 0.1556 | 1 |
| 0.15561 | 1 |
| 0.15562 | 1 |
| 0.15563 | 1 |
| 0.15564 | 1 |
| 0.15565 | 1 |
| 0.15566 | 1 |
| 0.15567 | 1 |
| 0.15568 | 1 |
| 0.15569 | 1 |
| 0.1557 | 1 |
| 0.15571 | 1 |
| 0.15572 | 1 |
| 0.15573 | 1 |
| 0.15574 | 1 |
| 0.15575 | 1 |
| 0.15576 | 1 |
| 0.15577 | 1 |
| 0.15578 | 1 |
| 0.15579 | 1 |
| 0.1558 | 1 |
| 0.15581 | 1 |
| 0.15582 | 1 |
| 0.15583 | 1 |
| 0.15584 | 1 |
| 0.15585 | 1 |
| 0.15586 | 1 |
| 0.15587 | 1 |
| 0.15588 | 1 |
| 0.15589 | 1 |
| 0.1559 | 1 |
| 0.15591 | 1 |
| 0.15592 | 1 |
| 0.15593 | 1 |
| 0.15594 | 1 |
| 0.15595 | 1 |
| 0.15596 | 1 |
| 0.15597 | 1 |
| 0.15598 | 1 |
| 0.15599 | 1 |
| 0.156 | 1 |
| 0.15601 | 1 |
| 0.15602 | 1 |
| 0.15603 | 1 |
| 0.15604 | 1 |
| 0.15605 | 1 |
| 0.15606 | 1 |
| 0.15607 | 1 |
| 0.15608 | 1 |
| 0.15609 | 1 |
| 0.1561 | 1 |
| 0.15611 | 1 |
| 0.15612 | 1 |
| 0.15613 | 1 |
| 0.15614 | 1 |
| 0.15615 | 1 |
| 0.15616 | 1 |
| 0.15617 | 1 |
| 0.15618 | 1 |
| 0.15619 | 1 |
| 0.1562 | 1 |
| 0.15621 | 1 |
| 0.15622 | 1 |
| 0.15623 | 1 |
| 0.15624 | 1 |
| 0.15625 | 1 |
| 0.15626 | 1 |
| 0.15627 | 1 |
| 0.15628 | 1 |
| 0.15629 | 1 |
| 0.1563 | 1 |
| 0.15631 | 1 |
| 0.15632 | 1 |
| 0.15633 | 1 |
| 0.15634 | 1 |
| 0.15635 | 1 |
| 0.15636 | 1 |
| 0.15637 | 1 |
| 0.15638 | 1 |
| 0.15639 | 1 |
| 0.1564 | 1 |
| 0.15641 | 1 |
| 0.15642 | 1 |
| 0.15643 | 1 |
| 0.15644 | 1 |
| 0.15645 | 1 |
| 0.15646 | 1 |
| 0.15647 | 1 |
| 0.15648 | 1 |
| 0.15649 | 1 |
| 0.1565 | 1 |
| 0.15651 | 1 |
| 0.15652 | 1 |
| 0.15653 | 1 |
| 0.15654 | 1 |
| 0.15655 | 1 |
| 0.15656 | 1 |
| 0.15657 | 1 |
| 0.15658 | 1 |
| 0.15659 | 1 |
| 0.1566 | 1 |
| 0.15661 | 1 |
| 0.15662 | 1 |
| 0.15663 | 1 |
| 0.15664 | 1 |
| 0.15665 | 1 |
| 0.15666 | 1 |
| 0.15667 | 1 |
| 0.15668 | 1 |
| 0.15669 | 1 |
| 0.1567 | 1 |
| 0.15671 | 1 |
| 0.15672 | 1 |
| 0.15673 | 1 |
| 0.15674 | 1 |
| 0.15675 | 1 |
| 0.15676 | 1 |
| 0.15677 | 1 |
| 0.15678 | 1 |
| 0.15679 | 1 |
| 0.1568 | 1 |
| 0.15681 | 1 |
| 0.15682 | 1 |
| 0.15683 | 1 |
| 0.15684 | 1 |
| 0.15685 | 1 |
| 0.15686 | 1 |
| 0.15687 | 1 |
| 0.15688 | 1 |
| 0.15689 | 1 |
| 0.1569 | 1 |
| 0.15691 | 1 |
| 0.15692 | 1 |
| 0.15693 | 1 |
| 0.15694 | 1 |
| 0.15695 | 1 |
| 0.15696 | 1 |
| 0.15697 | 1 |
| 0.15698 | 1 |
| 0.15699 | 1 |
| 0.157 | 1 |
| 0.15701 | 1 |
| 0.15702 | 1 |
| 0.15703 | 1 |
| 0.15704 | 1 |
| 0.15705 | 1 |
| 0.15706 | 1 |
| 0.15707 | 1 |
| 0.15708 | 1 |
| 0.15709 | 1 |
| 0.1571 | 1 |
| 0.15711 | 1 |
| 0.15712 | 1 |
| 0.15713 | 1 |
| 0.15714 | 1 |
| 0.15715 | 1 |
| 0.15716 | 1 |
| 0.15717 | 1 |
| 0.15718 | 1 |
| 0.15719 | 1 |
| 0.1572 | 1 |
| 0.15721 | 1 |
| 0.15722 | 1 |
| 0.15723 | 1 |
| 0.15724 | 1 |
| 0.15725 | 1 |
| 0.15726 | 1 |
| 0.15727 | 1 |
| 0.15728 | 1 |
| 0.15729 | 1 |
| 0.1573 | 1 |
| 0.15731 | 1 |
| 0.15732 | 1 |
| 0.15733 | 1 |
| 0.15734 | 1 |
| 0.15735 | 1 |
| 0.15736 | 1 |
| 0.15737 | 1 |
| 0.15738 | 1 |
| 0.15739 | 1 |
| 0.1574 | 1 |
| 0.15741 | 1 |
| 0.15742 | 1 |
| 0.15743 | 1 |
| 0.15744 | 1 |
| 0.15745 | 1 |
| 0.15746 | 1 |
| 0.15747 | 1 |
| 0.15748 | 1 |
| 0.15749 | 1 |
| 0.1575 | 1 |
| 0.15751 | 1 |
| 0.15752 | 1 |
| 0.15753 | 1 |
| 0.15754 | 1 |
| 0.15755 | 1 |
| 0.15756 | 1 |
| 0.15757 | 1 |
| 0.15758 | 1 |
| 0.15759 | 1 |
| 0.1576 | 1 |
| 0.15761 | 1 |
| 0.15762 | 1 |
| 0.15763 | 1 |
| 0.15764 | 1 |
| 0.15765 | 1 |
| 0.15766 | 1 |
| 0.15767 | 1 |
| 0.15768 | 1 |
| 0.15769 | 1 |
| 0.1577 | 1 |
| 0.15771 | 1 |
| 0.15772 | 1 |
| 0.15773 | 1 |
| 0.15774 | 1 |
| 0.15775 | 1 |
| 0.15776 | 1 |
| 0.15777 | 1 |
| 0.15778 | 1 |
| 0.15779 | 1 |
| 0.1578 | 1 |
| 0.15781 | 1 |
| 0.15782 | 1 |
| 0.15783 | 1 |
| 0.15784 | 1 |
| 0.15785 | 1 |
| 0.15786 | 1 |
| 0.15787 | 1 |
| 0.15788 | 1 |
| 0.15789 | 1 |
| 0.1579 | 1 |
| 0.15791 | 1 |
| 0.15792 | 1 |
| 0.15793 | 1 |
| 0.15794 | 1 |
| 0.15795 | 1 |
| 0.15796 | 1 |
| 0.15797 | 1 |
| 0.15798 | 1 |
| 0.15799 | 1 |
| 0.158 | 1 |
| 0.15801 | 1 |
| 0.15802 | 1 |
| 0.15803 | 1 |
| 0.15804 | 1 |
| 0.15805 | 1 |
| 0.15806 | 1 |
| 0.15807 | 1 |
| 0.15808 | 1 |
| 0.15809 | 1 |
| 0.1581 | 1 |
| 0.15811 | 1 |
| 0.15812 | 1 |
| 0.15813 | 1 |
| 0.15814 | 1 |
| 0.15815 | 1 |
| 0.15816 | 1 |
| 0.15817 | 1 |
| 0.15818 | 1 |
| 0.15819 | 1 |
| 0.1582 | 1 |
| 0.15821 | 1 |
| 0.15822 | 1 |
| 0.15823 | 1 |
| 0.15824 | 1 |
| 0.15825 | 1 |
| 0.15826 | 1 |
| 0.15827 | 1 |
| 0.15828 | 1 |
| 0.15829 | 1 |
| 0.1583 | 1 |
| 0.15831 | 1 |
| 0.15832 | 1 |
| 0.15833 | 1 |
| 0.15834 | 1 |
| 0.15835 | 1 |
| 0.15836 | 1 |
| 0.15837 | 1 |
| 0.15838 | 1 |
| 0.15839 | 1 |
| 0.1584 | 1 |
| 0.15841 | 1 |
| 0.15842 | 1 |
| 0.15843 | 1 |
| 0.15844 | 1 |
| 0.15845 | 1 |
| 0.15846 | 1 |
| 0.15847 | 1 |
| 0.15848 | 1 |
| 0.15849 | 1 |
| 0.1585 | 1 |
| 0.15851 | 1 |
| 0.15852 | 1 |
| 0.15853 | 1 |
| 0.15854 | 1 |
| 0.15855 | 1 |
| 0.15856 | 1 |
| 0.15857 | 1 |
| 0.15858 | 1 |
| 0.15859 | 1 |
| 0.1586 | 1 |
| 0.15861 | 1 |
| 0.15862 | 1 |
| 0.15863 | 1 |
| 0.15864 | 1 |
| 0.15865 | 1 |
| 0.15866 | 1 |
| 0.15867 | 1 |
| 0.15868 | 1 |
| 0.15869 | 1 |
| 0.1587 | 1 |
| 0.15871 | 1 |
| 0.15872 | 1 |
| 0.15873 | 1 |
| 0.15874 | 1 |
| 0.15875 | 1 |
| 0.15876 | 1 |
| 0.15877 | 1 |
| 0.15878 | 1 |
| 0.15879 | 1 |
| 0.1588 | 1 |
| 0.15881 | 1 |
| 0.15882 | 1 |
| 0.15883 | 1 |
| 0.15884 | 1 |
| 0.15885 | 1 |
| 0.15886 | 1 |
| 0.15887 | 1 |
| 0.15888 | 1 |
| 0.15889 | 1 |
| 0.1589 | 1 |
| 0.15891 | 1 |
| 0.15892 | 1 |
| 0.15893 | 1 |
| 0.15894 | 1 |
| 0.15895 | 1 |
| 0.15896 | 1 |
| 0.15897 | 1 |
| 0.15898 | 1 |
| 0.15899 | 1 |
| 0.159 | 1 |
| 0.15901 | 1 |
| 0.15902 | 1 |
| 0.15903 | 1 |
| 0.15904 | 1 |
| 0.15905 | 1 |
| 0.15906 | 1 |
| 0.15907 | 1 |
| 0.15908 | 1 |
| 0.15909 | 1 |
| 0.1591 | 1 |
| 0.15911 | 1 |
| 0.15912 | 1 |
| 0.15913 | 1 |
| 0.15914 | 1 |
| 0.15915 | 1 |
| 0.15916 | 1 |
| 0.15917 | 1 |
| 0.15918 | 1 |
| 0.15919 | 1 |
| 0.1592 | 1 |
| 0.15921 | 1 |
| 0.15922 | 1 |
| 0.15923 | 1 |
| 0.15924 | 1 |
| 0.15925 | 1 |
| 0.15926 | 1 |
| 0.15927 | 1 |
| 0.15928 | 1 |
| 0.15929 | 1 |
| 0.1593 | 1 |
| 0.15931 | 1 |
| 0.15932 | 1 |
| 0.15933 | 1 |
| 0.15934 | 1 |
| 0.15935 | 1 |
| 0.15936 | 1 |
| 0.15937 | 1 |
| 0.15938 | 1 |
| 0.15939 | 1 |
| 0.1594 | 1 |
| 0.15941 | 1 |
| 0.15942 | 1 |
| 0.15943 | 1 |
| 0.15944 | 1 |
| 0.15945 | 1 |
| 0.15946 | 1 |
| 0.15947 | 1 |
| 0.15948 | 1 |
| 0.15949 | 1 |
| 0.1595 | 1 |
| 0.15951 | 1 |
| 0.15952 | 1 |
| 0.15953 | 1 |
| 0.15954 | 1 |
| 0.15955 | 1 |
| 0.15956 | 1 |
| 0.15957 | 1 |
| 0.15958 | 1 |
| 0.15959 | 1 |
| 0.1596 | 1 |
| 0.15961 | 1 |
| 0.15962 | 1 |
| 0.15963 | 1 |
| 0.15964 | 1 |
| 0.15965 | 1 |
| 0.15966 | 1 |
| 0.15967 | 1 |
| 0.15968 | 1 |
| 0.15969 | 1 |
| 0.1597 | 1 |
| 0.15971 | 1 |
| 0.15972 | 1 |
| 0.15973 | 1 |
| 0.15974 | 1 |
| 0.15975 | 1 |
| 0.15976 | 1 |
| 0.15977 | 1 |
| 0.15978 | 1 |
| 0.15979 | 1 |
| 0.1598 | 1 |
| 0.15981 | 1 |
| 0.15982 | 1 |
| 0.15983 | 1 |
| 0.15984 | 1 |
| 0.15985 | 1 |
| 0.15986 | 1 |
| 0.15987 | 1 |
| 0.15988 | 1 |
| 0.15989 | 1 |
| 0.1599 | 1 |
| 0.15991 | 1 |
| 0.15992 | 1 |
| 0.15993 | 1 |
| 0.15994 | 1 |
| 0.15995 | 1 |
| 0.15996 | 1 |
| 0.15997 | 1 |
| 0.15998 | 1 |
| 0.15999 | 1 |
| 0.16 | 1 |
| 0.16001 | 1 |
| 0.16002 | 1 |
| 0.16003 | 1 |
| 0.16004 | 1 |
| 0.16005 | 1 |
| 0.16006 | 1 |
| 0.16007 | 1 |
| 0.16008 | 1 |
| 0.16009 | 1 |
| 0.1601 | 1 |
| 0.16011 | 1 |
| 0.16012 | 1 |
| 0.16013 | 1 |
| 0.16014 | 1 |
| 0.16015 | 1 |
| 0.16016 | 1 |
| 0.16017 | 1 |
| 0.16018 | 1 |
| 0.16019 | 1 |
| 0.1602 | 1 |
| 0.16021 | 1 |
| 0.16022 | 1 |
| 0.16023 | 1 |
| 0.16024 | 1 |
| 0.16025 | 1 |
| 0.16026 | 1 |
| 0.16027 | 1 |
| 0.16028 | 1 |
| 0.16029 | 1 |
| 0.1603 | 1 |
| 0.16031 | 1 |
| 0.16032 | 1 |
| 0.16033 | 1 |
| 0.16034 | 1 |
| 0.16035 | 1 |
| 0.16036 | 1 |
| 0.16037 | 1 |
| 0.16038 | 1 |
| 0.16039 | 1 |
| 0.1604 | 1 |
| 0.16041 | 1 |
| 0.16042 | 1 |
| 0.16043 | 1 |
| 0.16044 | 1 |
| 0.16045 | 1 |
| 0.16046 | 1 |
| 0.16047 | 1 |
| 0.16048 | 1 |
| 0.16049 | 1 |
| 0.1605 | 1 |
| 0.16051 | 1 |
| 0.16052 | 1 |
| 0.16053 | 1 |
| 0.16054 | 1 |
| 0.16055 | 1 |
| 0.16056 | 1 |
| 0.16057 | 1 |
| 0.16058 | 1 |
| 0.16059 | 1 |
| 0.1606 | 1 |
| 0.16061 | 1 |
| 0.16062 | 1 |
| 0.16063 | 1 |
| 0.16064 | 1 |
| 0.16065 | 1 |
| 0.16066 | 1 |
| 0.16067 | 1 |
| 0.16068 | 1 |
| 0.16069 | 1 |
| 0.1607 | 1 |
| 0.16071 | 1 |
| 0.16072 | 1 |
| 0.16073 | 1 |
| 0.16074 | 1 |
| 0.16075 | 1 |
| 0.16076 | 1 |
| 0.16077 | 1 |
| 0.16078 | 1 |
| 0.16079 | 1 |
| 0.1608 | 1 |
| 0.16081 | 1 |
| 0.16082 | 1 |
| 0.16083 | 1 |
| 0.16084 | 1 |
| 0.16085 | 1 |
| 0.16086 | 1 |
| 0.16087 | 1 |
| 0.16088 | 1 |
| 0.16089 | 1 |
| 0.1609 | 1 |
| 0.16091 | 1 |
| 0.16092 | 1 |
| 0.16093 | 1 |
| 0.16094 | 1 |
| 0.16095 | 1 |
| 0.16096 | 1 |
| 0.16097 | 1 |
| 0.16098 | 1 |
| 0.16099 | 1 |
| 0.161 | 1 |
| 0.16101 | 1 |
| 0.16102 | 1 |
| 0.16103 | 1 |
| 0.16104 | 1 |
| 0.16105 | 1 |
| 0.16106 | 1 |
| 0.16107 | 1 |
| 0.16108 | 1 |
| 0.16109 | 1 |
| 0.1611 | 1 |
| 0.16111 | 1 |
| 0.16112 | 1 |
| 0.16113 | 1 |
| 0.16114 | 1 |
| 0.16115 | 1 |
| 0.16116 | 1 |
| 0.16117 | 1 |
| 0.16118 | 1 |
| 0.16119 | 1 |
| 0.1612 | 1 |
| 0.16121 | 1 |
| 0.16122 | 1 |
| 0.16123 | 1 |
| 0.16124 | 1 |
| 0.16125 | 1 |
| 0.16126 | 1 |
| 0.16127 | 1 |
| 0.16128 | 1 |
| 0.16129 | 1 |
| 0.1613 | 1 |
| 0.16131 | 1 |
| 0.16132 | 1 |
| 0.16133 | 1 |
| 0.16134 | 1 |
| 0.16135 | 1 |
| 0.16136 | 1 |
| 0.16137 | 1 |
| 0.16138 | 1 |
| 0.16139 | 1 |
| 0.1614 | 1 |
| 0.16141 | 1 |
| 0.16142 | 1 |
| 0.16143 | 1 |
| 0.16144 | 1 |
| 0.16145 | 1 |
| 0.16146 | 1 |
| 0.16147 | 1 |
| 0.16148 | 1 |
| 0.16149 | 1 |
| 0.1615 | 1 |
| 0.16151 | 1 |
| 0.16152 | 1 |
| 0.16153 | 1 |
| 0.16154 | 1 |
| 0.16155 | 1 |
| 0.16156 | 1 |
| 0.16157 | 1 |
| 0.16158 | 1 |
| 0.16159 | 1 |
| 0.1616 | 1 |
| 0.16161 | 1 |
| 0.16162 | 1 |
| 0.16163 | 1 |
| 0.16164 | 1 |
| 0.16165 | 1 |
| 0.16166 | 1 |
| 0.16167 | 1 |
| 0.16168 | 1 |
| 0.16169 | 1 |
| 0.1617 | 1 |
| 0.16171 | 1 |
| 0.16172 | 1 |
| 0.16173 | 1 |
| 0.16174 | 1 |
| 0.16175 | 1 |
| 0.16176 | 1 |
| 0.16177 | 1 |
| 0.16178 | 1 |
| 0.16179 | 1 |
| 0.1618 | 1 |
| 0.16181 | 1 |
| 0.16182 | 1 |
| 0.16183 | 1 |
| 0.16184 | 1 |
| 0.16185 | 1 |
| 0.16186 | 1 |
| 0.16187 | 1 |
| 0.16188 | 1 |
| 0.16189 | 1 |
| 0.1619 | 1 |
| 0.16191 | 1 |
| 0.16192 | 1 |
| 0.16193 | 1 |
| 0.16194 | 1 |
| 0.16195 | 1 |
| 0.16196 | 1 |
| 0.16197 | 1 |
| 0.16198 | 1 |
| 0.16199 | 1 |
| 0.162 | 1 |
| 0.16201 | 1 |
| 0.16202 | 1 |
| 0.16203 | 1 |
| 0.16204 | 1 |
| 0.16205 | 1 |
| 0.16206 | 1 |
| 0.16207 | 1 |
| 0.16208 | 1 |
| 0.16209 | 1 |
| 0.1621 | 1 |
| 0.16211 | 1 |
| 0.16212 | 1 |
| 0.16213 | 1 |
| 0.16214 | 1 |
| 0.16215 | 1 |
| 0.16216 | 1 |
| 0.16217 | 1 |
| 0.16218 | 1 |
| 0.16219 | 1 |
| 0.1622 | 1 |
| 0.16221 | 1 |
| 0.16222 | 1 |
| 0.16223 | 1 |
| 0.16224 | 1 |
| 0.16225 | 1 |
| 0.16226 | 1 |
| 0.16227 | 1 |
| 0.16228 | 1 |
| 0.16229 | 1 |
| 0.1623 | 1 |
| 0.16231 | 1 |
| 0.16232 | 1 |
| 0.16233 | 1 |
| 0.16234 | 1 |
| 0.16235 | 1 |
| 0.16236 | 1 |
| 0.16237 | 1 |
| 0.16238 | 1 |
| 0.16239 | 1 |
| 0.1624 | 1 |
| 0.16241 | 1 |
| 0.16242 | 1 |
| 0.16243 | 1 |
| 0.16244 | 1 |
| 0.16245 | 1 |
| 0.16246 | 1 |
| 0.16247 | 1 |
| 0.16248 | 1 |
| 0.16249 | 1 |
| 0.1625 | 1 |
| 0.16251 | 1 |
| 0.16252 | 1 |
| 0.16253 | 1 |
| 0.16254 | 1 |
| 0.16255 | 1 |
| 0.16256 | 1 |
| 0.16257 | 1 |
| 0.16258 | 1 |
| 0.16259 | 1 |
| 0.1626 | 1 |
| 0.16261 | 1 |
| 0.16262 | 1 |
| 0.16263 | 1 |
| 0.16264 | 1 |
| 0.16265 | 1 |
| 0.16266 | 1 |
| 0.16267 | 1 |
| 0.16268 | 1 |
| 0.16269 | 1 |
| 0.1627 | 1 |
| 0.16271 | 1 |
| 0.16272 | 1 |
| 0.16273 | 1 |
| 0.16274 | 1 |
| 0.16275 | 1 |
| 0.16276 | 1 |
| 0.16277 | 1 |
| 0.16278 | 1 |
| 0.16279 | 1 |
| 0.1628 | 1 |
| 0.16281 | 1 |
| 0.16282 | 1 |
| 0.16283 | 1 |
| 0.16284 | 1 |
| 0.16285 | 1 |
| 0.16286 | 1 |
| 0.16287 | 1 |
| 0.16288 | 1 |
| 0.16289 | 1 |
| 0.1629 | 1 |
| 0.16291 | 1 |
| 0.16292 | 1 |
| 0.16293 | 1 |
| 0.16294 | 1 |
| 0.16295 | 1 |
| 0.16296 | 1 |
| 0.16297 | 1 |
| 0.16298 | 1 |
| 0.16299 | 1 |
| 0.163 | 1 |
| 0.16301 | 1 |
| 0.16302 | 1 |
| 0.16303 | 1 |
| 0.16304 | 1 |
| 0.16305 | 1 |
| 0.16306 | 1 |
| 0.16307 | 1 |
| 0.16308 | 1 |
| 0.16309 | 1 |
| 0.1631 | 1 |
| 0.16311 | 1 |
| 0.16312 | 1 |
| 0.16313 | 1 |
| 0.16314 | 1 |
| 0.16315 | 1 |
| 0.16316 | 1 |
| 0.16317 | 1 |
| 0.16318 | 1 |
| 0.16319 | 1 |
| 0.1632 | 1 |
| 0.16321 | 1 |
| 0.16322 | 1 |
| 0.16323 | 1 |
| 0.16324 | 1 |
| 0.16325 | 1 |
| 0.16326 | 1 |
| 0.16327 | 1 |
| 0.16328 | 1 |
| 0.16329 | 1 |
| 0.1633 | 1 |
| 0.16331 | 1 |
| 0.16332 | 1 |
| 0.16333 | 1 |
| 0.16334 | 1 |
| 0.16335 | 1 |
| 0.16336 | 1 |
| 0.16337 | 1 |
| 0.16338 | 1 |
| 0.16339 | 1 |
| 0.1634 | 1 |
| 0.16341 | 1 |
| 0.16342 | 1 |
| 0.16343 | 1 |
| 0.16344 | 1 |
| 0.16345 | 1 |
| 0.16346 | 1 |
| 0.16347 | 1 |
| 0.16348 | 1 |
| 0.16349 | 1 |
| 0.1635 | 1 |
| 0.16351 | 1 |
| 0.16352 | 1 |
| 0.16353 | 1 |
| 0.16354 | 1 |
| 0.16355 | 1 |
| 0.16356 | 1 |
| 0.16357 | 1 |
| 0.16358 | 1 |
| 0.16359 | 1 |
| 0.1636 | 1 |
| 0.16361 | 1 |
| 0.16362 | 1 |
| 0.16363 | 1 |
| 0.16364 | 1 |
| 0.16365 | 1 |
| 0.16366 | 1 |
| 0.16367 | 1 |
| 0.16368 | 1 |
| 0.16369 | 1 |
| 0.1637 | 1 |
| 0.16371 | 1 |
| 0.16372 | 1 |
| 0.16373 | 1 |
| 0.16374 | 1 |
| 0.16375 | 1 |
| 0.16376 | 1 |
| 0.16377 | 1 |
| 0.16378 | 1 |
| 0.16379 | 1 |
| 0.1638 | 1 |
| 0.16381 | 1 |
| 0.16382 | 1 |
| 0.16383 | 1 |
| 0.16384 | 1 |
| 0.16385 | 1 |
| 0.16386 | 1 |
| 0.16387 | 1 |
| 0.16388 | 1 |
| 0.16389 | 1 |
| 0.1639 | 1 |
| 0.16391 | 1 |
| 0.16392 | 1 |
| 0.16393 | 1 |
| 0.16394 | 1 |
| 0.16395 | 1 |
| 0.16396 | 1 |
| 0.16397 | 1 |
| 0.16398 | 1 |
| 0.16399 | 1 |
| 0.164 | 1 |
| 0.16401 | 1 |
| 0.16402 | 1 |
| 0.16403 | 1 |
| 0.16404 | 1 |
| 0.16405 | 1 |
| 0.16406 | 1 |
| 0.16407 | 1 |
| 0.16408 | 1 |
| 0.16409 | 1 |
| 0.1641 | 1 |
| 0.16411 | 1 |
| 0.16412 | 1 |
| 0.16413 | 1 |
| 0.16414 | 1 |
| 0.16415 | 1 |
| 0.16416 | 1 |
| 0.16417 | 1 |
| 0.16418 | 1 |
| 0.16419 | 1 |
| 0.1642 | 1 |
| 0.16421 | 1 |
| 0.16422 | 1 |
| 0.16423 | 1 |
| 0.16424 | 1 |
| 0.16425 | 1 |
| 0.16426 | 1 |
| 0.16427 | 1 |
| 0.16428 | 1 |
| 0.16429 | 1 |
| 0.1643 | 1 |
| 0.16431 | 1 |
| 0.16432 | 1 |
| 0.16433 | 1 |
| 0.16434 | 1 |
| 0.16435 | 1 |
| 0.16436 | 1 |
| 0.16437 | 1 |
| 0.16438 | 1 |
| 0.16439 | 1 |
| 0.1644 | 1 |
| 0.16441 | 1 |
| 0.16442 | 1 |
| 0.16443 | 1 |
| 0.16444 | 1 |
| 0.16445 | 1 |
| 0.16446 | 1 |
| 0.16447 | 1 |
| 0.16448 | 1 |
| 0.16449 | 1 |
| 0.1645 | 1 |
| 0.16451 | 1 |
| 0.16452 | 1 |
| 0.16453 | 1 |
| 0.16454 | 1 |
| 0.16455 | 1 |
| 0.16456 | 1 |
| 0.16457 | 1 |
| 0.16458 | 1 |
| 0.16459 | 1 |
| 0.1646 | 1 |
| 0.16461 | 1 |
| 0.16462 | 1 |
| 0.16463 | 1 |
| 0.16464 | 1 |
| 0.16465 | 1 |
| 0.16466 | 1 |
| 0.16467 | 1 |
| 0.16468 | 1 |
| 0.16469 | 1 |
| 0.1647 | 1 |
| 0.16471 | 1 |
| 0.16472 | 1 |
| 0.16473 | 1 |
| 0.16474 | 1 |
| 0.16475 | 1 |
| 0.16476 | 1 |
| 0.16477 | 1 |
| 0.16478 | 1 |
| 0.16479 | 1 |
| 0.1648 | 1 |
| 0.16481 | 1 |
| 0.16482 | 1 |
| 0.16483 | 1 |
| 0.16484 | 1 |
| 0.16485 | 1 |
| 0.16486 | 1 |
| 0.16487 | 1 |
| 0.16488 | 1 |
| 0.16489 | 1 |
| 0.1649 | 1 |
| 0.16491 | 1 |
| 0.16492 | 1 |
| 0.16493 | 1 |
| 0.16494 | 1 |
| 0.16495 | 1 |
| 0.16496 | 1 |
| 0.16497 | 1 |
| 0.16498 | 1 |
| 0.16499 | 1 |
| 0.165 | 1 |
| 0.16501 | 1 |
| 0.16502 | 1 |
| 0.16503 | 1 |
| 0.16504 | 1 |
| 0.16505 | 1 |
| 0.16506 | 1 |
| 0.16507 | 1 |
| 0.16508 | 1 |
| 0.16509 | 1 |
| 0.1651 | 1 |
| 0.16511 | 1 |
| 0.16512 | 1 |
| 0.16513 | 1 |
| 0.16514 | 1 |
| 0.16515 | 1 |
| 0.16516 | 1 |
| 0.16517 | 1 |
| 0.16518 | 1 |
| 0.16519 | 1 |
| 0.1652 | 1 |
| 0.16521 | 1 |
| 0.16522 | 1 |
| 0.16523 | 1 |
| 0.16524 | 1 |
| 0.16525 | 1 |
| 0.16526 | 1 |
| 0.16527 | 1 |
| 0.16528 | 1 |
| 0.16529 | 1 |
| 0.1653 | 1 |
| 0.16531 | 1 |
| 0.16532 | 1 |
| 0.16533 | 1 |
| 0.16534 | 1 |
| 0.16535 | 1 |
| 0.16536 | 1 |
| 0.16537 | 1 |
| 0.16538 | 1 |
| 0.16539 | 1 |
| 0.1654 | 1 |
| 0.16541 | 1 |
| 0.16542 | 1 |
| 0.16543 | 1 |
| 0.16544 | 1 |
| 0.16545 | 1 |
| 0.16546 | 1 |
| 0.16547 | 1 |
| 0.16548 | 1 |
| 0.16549 | 1 |
| 0.1655 | 1 |
| 0.16551 | 1 |
| 0.16552 | 1 |
| 0.16553 | 1 |
| 0.16554 | 1 |
| 0.16555 | 1 |
| 0.16556 | 1 |
| 0.16557 | 1 |
| 0.16558 | 1 |
| 0.16559 | 1 |
| 0.1656 | 1 |
| 0.16561 | 1 |
| 0.16562 | 1 |
| 0.16563 | 1 |
| 0.16564 | 1 |
| 0.16565 | 1 |
| 0.16566 | 1 |
| 0.16567 | 1 |
| 0.16568 | 1 |
| 0.16569 | 1 |
| 0.1657 | 1 |
| 0.16571 | 1 |
| 0.16572 | 1 |
| 0.16573 | 1 |
| 0.16574 | 1 |
| 0.16575 | 1 |
| 0.16576 | 1 |
| 0.16577 | 1 |
| 0.16578 | 1 |
| 0.16579 | 1 |
| 0.1658 | 1 |
| 0.16581 | 1 |
| 0.16582 | 1 |
| 0.16583 | 1 |
| 0.16584 | 1 |
| 0.16585 | 1 |
| 0.16586 | 1 |
| 0.16587 | 1 |
| 0.16588 | 1 |
| 0.16589 | 1 |
| 0.1659 | 1 |
| 0.16591 | 1 |
| 0.16592 | 1 |
| 0.16593 | 1 |
| 0.16594 | 1 |
| 0.16595 | 1 |
| 0.16596 | 1 |
| 0.16597 | 1 |
| 0.16598 | 1 |
| 0.16599 | 1 |
| 0.166 | 1 |
| 0.16601 | 1 |
| 0.16602 | 1 |
| 0.16603 | 1 |
| 0.16604 | 1 |
| 0.16605 | 1 |
| 0.16606 | 1 |
| 0.16607 | 1 |
| 0.16608 | 1 |
| 0.16609 | 1 |
| 0.1661 | 1 |
| 0.16611 | 1 |
| 0.16612 | 1 |
| 0.16613 | 1 |
| 0.16614 | 1 |
| 0.16615 | 1 |
| 0.16616 | 1 |
| 0.16617 | 1 |
| 0.16618 | 1 |
| 0.16619 | 1 |
| 0.1662 | 1 |
| 0.16621 | 1 |
| 0.16622 | 1 |
| 0.16623 | 1 |
| 0.16624 | 1 |
| 0.16625 | 1 |
| 0.16626 | 1 |
| 0.16627 | 1 |
| 0.16628 | 1 |
| 0.16629 | 1 |
| 0.1663 | 1 |
| 0.16631 | 1 |
| 0.16632 | 1 |
| 0.16633 | 1 |
| 0.16634 | 1 |
| 0.16635 | 1 |
| 0.16636 | 1 |
| 0.16637 | 1 |
| 0.16638 | 1 |
| 0.16639 | 1 |
| 0.1664 | 1 |
| 0.16641 | 1 |
| 0.16642 | 1 |
| 0.16643 | 1 |
| 0.16644 | 1 |
| 0.16645 | 1 |
| 0.16646 | 1 |
| 0.16647 | 1 |
| 0.16648 | 1 |
| 0.16649 | 1 |
| 0.1665 | 1 |
| 0.16651 | 1 |
| 0.16652 | 1 |
| 0.16653 | 1 |
| 0.16654 | 1 |
| 0.16655 | 1 |
| 0.16656 | 1 |
| 0.16657 | 1 |
| 0.16658 | 1 |
| 0.16659 | 1 |
| 0.1666 | 1 |
| 0.16661 | 1 |
| 0.16662 | 1 |
| 0.16663 | 1 |
| 0.16664 | 1 |
| 0.16665 | 1 |
| 0.16666 | 1 |
| 0.16667 | 1 |
| 0.16668 | 1 |
| 0.16669 | 1 |
| 0.1667 | 1 |
| 0.16671 | 1 |
| 0.16672 | 1 |
| 0.16673 | 1 |
| 0.16674 | 1 |
| 0.16675 | 1 |
| 0.16676 | 1 |
| 0.16677 | 1 |
| 0.16678 | 1 |
| 0.16679 | 1 |
| 0.1668 | 1 |
| 0.16681 | 1 |
| 0.16682 | 1 |
| 0.16683 | 1 |
| 0.16684 | 1 |
| 0.16685 | 1 |
| 0.16686 | 1 |
| 0.16687 | 1 |
| 0.16688 | 1 |
| 0.16689 | 1 |
| 0.1669 | 1 |
| 0.16691 | 1 |
| 0.16692 | 1 |
| 0.16693 | 1 |
| 0.16694 | 1 |
| 0.16695 | 1 |
| 0.16696 | 1 |
| 0.16697 | 1 |
| 0.16698 | 1 |
| 0.16699 | 1 |
| 0.167 | 1 |
| 0.16701 | 1 |
| 0.16702 | 1 |
| 0.16703 | 1 |
| 0.16704 | 1 |
| 0.16705 | 1 |
| 0.16706 | 1 |
| 0.16707 | 1 |
| 0.16708 | 1 |
| 0.16709 | 1 |
| 0.1671 | 1 |
| 0.16711 | 1 |
| 0.16712 | 1 |
| 0.16713 | 1 |
| 0.16714 | 1 |
| 0.16715 | 1 |
| 0.16716 | 1 |
| 0.16717 | 1 |
| 0.16718 | 1 |
| 0.16719 | 1 |
| 0.1672 | 1 |
| 0.16721 | 1 |
| 0.16722 | 1 |
| 0.16723 | 1 |
| 0.16724 | 1 |
| 0.16725 | 1 |
| 0.16726 | 1 |
| 0.16727 | 1 |
| 0.16728 | 1 |
| 0.16729 | 1 |
| 0.1673 | 1 |
| 0.16731 | 1 |
| 0.16732 | 1 |
| 0.16733 | 1 |
| 0.16734 | 1 |
| 0.16735 | 1 |
| 0.16736 | 1 |
| 0.16737 | 1 |
| 0.16738 | 1 |
| 0.16739 | 1 |
| 0.1674 | 1 |
| 0.16741 | 1 |
| 0.16742 | 1 |
| 0.16743 | 1 |
| 0.16744 | 1 |
| 0.16745 | 1 |
| 0.16746 | 1 |
| 0.16747 | 1 |
| 0.16748 | 1 |
| 0.16749 | 1 |
| 0.1675 | 1 |
| 0.16751 | 1 |
| 0.16752 | 1 |
| 0.16753 | 1 |
| 0.16754 | 1 |
| 0.16755 | 1 |
| 0.16756 | 1 |
| 0.16757 | 1 |
| 0.16758 | 1 |
| 0.16759 | 1 |
| 0.1676 | 1 |
| 0.16761 | 1 |
| 0.16762 | 1 |
| 0.16763 | 1 |
| 0.16764 | 1 |
| 0.16765 | 1 |
| 0.16766 | 1 |
| 0.16767 | 1 |
| 0.16768 | 1 |
| 0.16769 | 1 |
| 0.1677 | 1 |
| 0.16771 | 1 |
| 0.16772 | 1 |
| 0.16773 | 1 |
| 0.16774 | 1 |
| 0.16775 | 1 |
| 0.16776 | 1 |
| 0.16777 | 1 |
| 0.16778 | 1 |
| 0.16779 | 1 |
| 0.1678 | 1 |
| 0.16781 | 1 |
| 0.16782 | 1 |
| 0.16783 | 1 |
| 0.16784 | 1 |
| 0.16785 | 1 |
| 0.16786 | 1 |
| 0.16787 | 1 |
| 0.16788 | 1 |
| 0.16789 | 1 |
| 0.1679 | 1 |
| 0.16791 | 1 |
| 0.16792 | 1 |
| 0.16793 | 1 |
| 0.16794 | 1 |
| 0.16795 | 1 |
| 0.16796 | 1 |
| 0.16797 | 1 |
| 0.16798 | 1 |
| 0.16799 | 1 |
| 0.168 | 1 |
| 0.16801 | 1 |
| 0.16802 | 1 |
| 0.16803 | 1 |
| 0.16804 | 1 |
| 0.16805 | 1 |
| 0.16806 | 1 |
| 0.16807 | 1 |
| 0.16808 | 1 |
| 0.16809 | 1 |
| 0.1681 | 1 |
| 0.16811 | 1 |
| 0.16812 | 1 |
| 0.16813 | 1 |
| 0.16814 | 1 |
| 0.16815 | 1 |
| 0.16816 | 1 |
| 0.16817 | 1 |
| 0.16818 | 1 |
| 0.16819 | 1 |
| 0.1682 | 1 |
| 0.16821 | 1 |
| 0.16822 | 1 |
| 0.16823 | 1 |
| 0.16824 | 1 |
| 0.16825 | 1 |
| 0.16826 | 1 |
| 0.16827 | 1 |
| 0.16828 | 1 |
| 0.16829 | 1 |
| 0.1683 | 1 |
| 0.16831 | 1 |
| 0.16832 | 1 |
| 0.16833 | 1 |
| 0.16834 | 1 |
| 0.16835 | 1 |
| 0.16836 | 1 |
| 0.16837 | 1 |
| 0.16838 | 1 |
| 0.16839 | 1 |
| 0.1684 | 1 |
| 0.16841 | 1 |
| 0.16842 | 1 |
| 0.16843 | 1 |
| 0.16844 | 1 |
| 0.16845 | 1 |
| 0.16846 | 1 |
| 0.16847 | 1 |
| 0.16848 | 1 |
| 0.16849 | 1 |
| 0.1685 | 1 |
| 0.16851 | 1 |
| 0.16852 | 1 |
| 0.16853 | 1 |
| 0.16854 | 1 |
| 0.16855 | 1 |
| 0.16856 | 1 |
| 0.16857 | 1 |
| 0.16858 | 1 |
| 0.16859 | 1 |
| 0.1686 | 1 |
| 0.16861 | 1 |
| 0.16862 | 1 |
| 0.16863 | 1 |
| 0.16864 | 1 |
| 0.16865 | 1 |
| 0.16866 | 1 |
| 0.16867 | 1 |
| 0.16868 | 1 |
| 0.16869 | 1 |
| 0.1687 | 1 |
| 0.16871 | 1 |
| 0.16872 | 1 |
| 0.16873 | 1 |
| 0.16874 | 1 |
| 0.16875 | 1 |
| 0.16876 | 1 |
| 0.16877 | 1 |
| 0.16878 | 1 |
| 0.16879 | 1 |
| 0.1688 | 1 |
| 0.16881 | 1 |
| 0.16882 | 1 |
| 0.16883 | 1 |
| 0.16884 | 1 |
| 0.16885 | 1 |
| 0.16886 | 1 |
| 0.16887 | 1 |
| 0.16888 | 1 |
| 0.16889 | 1 |
| 0.1689 | 1 |
| 0.16891 | 1 |
| 0.16892 | 1 |
| 0.16893 | 1 |
| 0.16894 | 1 |
| 0.16895 | 1 |
| 0.16896 | 1 |
| 0.16897 | 1 |
| 0.16898 | 1 |
| 0.16899 | 1 |
| 0.169 | 1 |
| 0.16901 | 1 |
| 0.16902 | 1 |
| 0.16903 | 1 |
| 0.16904 | 1 |
| 0.16905 | 1 |
| 0.16906 | 1 |
| 0.16907 | 1 |
| 0.16908 | 1 |
| 0.16909 | 1 |
| 0.1691 | 1 |
| 0.16911 | 1 |
| 0.16912 | 1 |
| 0.16913 | 1 |
| 0.16914 | 1 |
| 0.16915 | 1 |
| 0.16916 | 1 |
| 0.16917 | 1 |
| 0.16918 | 1 |
| 0.16919 | 1 |
| 0.1692 | 1 |
| 0.16921 | 1 |
| 0.16922 | 1 |
| 0.16923 | 1 |
| 0.16924 | 1 |
| 0.16925 | 1 |
| 0.16926 | 1 |
| 0.16927 | 1 |
| 0.16928 | 1 |
| 0.16929 | 1 |
| 0.1693 | 1 |
| 0.16931 | 1 |
| 0.16932 | 1 |
| 0.16933 | 1 |
| 0.16934 | 1 |
| 0.16935 | 1 |
| 0.16936 | 1 |
| 0.16937 | 1 |
| 0.16938 | 1 |
| 0.16939 | 1 |
| 0.1694 | 1 |
| 0.16941 | 1 |
| 0.16942 | 1 |
| 0.16943 | 1 |
| 0.16944 | 1 |
| 0.16945 | 1 |
| 0.16946 | 1 |
| 0.16947 | 1 |
| 0.16948 | 1 |
| 0.16949 | 1 |
| 0.1695 | 1 |
| 0.16951 | 1 |
| 0.16952 | 1 |
| 0.16953 | 1 |
| 0.16954 | 1 |
| 0.16955 | 1 |
| 0.16956 | 1 |
| 0.16957 | 1 |
| 0.16958 | 1 |
| 0.16959 | 1 |
| 0.1696 | 1 |
| 0.16961 | 1 |
| 0.16962 | 1 |
| 0.16963 | 1 |
| 0.16964 | 1 |
| 0.16965 | 1 |
| 0.16966 | 1 |
| 0.16967 | 1 |
| 0.16968 | 1 |
| 0.16969 | 1 |
| 0.1697 | 1 |
| 0.16971 | 1 |
| 0.16972 | 1 |
| 0.16973 | 1 |
| 0.16974 | 1 |
| 0.16975 | 1 |
| 0.16976 | 1 |
| 0.16977 | 1 |
| 0.16978 | 1 |
| 0.16979 | 1 |
| 0.1698 | 1 |
| 0.16981 | 1 |
| 0.16982 | 1 |
| 0.16983 | 1 |
| 0.16984 | 1 |
| 0.16985 | 1 |
| 0.16986 | 1 |
| 0.16987 | 1 |
| 0.16988 | 1 |
| 0.16989 | 1 |
| 0.1699 | 1 |
| 0.16991 | 1 |
| 0.16992 | 1 |
| 0.16993 | 1 |
| 0.16994 | 1 |
| 0.16995 | 1 |
| 0.16996 | 1 |
| 0.16997 | 1 |
| 0.16998 | 1 |
| 0.16999 | 1 |
| 0.17 | 1 |
| 0.17001 | 1 |
| 0.17002 | 1 |
| 0.17003 | 1 |
| 0.17004 | 1 |
| 0.17005 | 1 |
| 0.17006 | 1 |
| 0.17007 | 1 |
| 0.17008 | 1 |
| 0.17009 | 1 |
| 0.1701 | 1 |
| 0.17011 | 1 |
| 0.17012 | 1 |
| 0.17013 | 1 |
| 0.17014 | 1 |
| 0.17015 | 1 |
| 0.17016 | 1 |
| 0.17017 | 1 |
| 0.17018 | 1 |
| 0.17019 | 1 |
| 0.1702 | 1 |
| 0.17021 | 1 |
| 0.17022 | 1 |
| 0.17023 | 1 |
| 0.17024 | 1 |
| 0.17025 | 1 |
| 0.17026 | 1 |
| 0.17027 | 1 |
| 0.17028 | 1 |
| 0.17029 | 1 |
| 0.1703 | 1 |
| 0.17031 | 1 |
| 0.17032 | 1 |
| 0.17033 | 1 |
| 0.17034 | 1 |
| 0.17035 | 1 |
| 0.17036 | 1 |
| 0.17037 | 1 |
| 0.17038 | 1 |
| 0.17039 | 1 |
| 0.1704 | 1 |
| 0.17041 | 1 |
| 0.17042 | 1 |
| 0.17043 | 1 |
| 0.17044 | 1 |
| 0.17045 | 1 |
| 0.17046 | 1 |
| 0.17047 | 1 |
| 0.17048 | 1 |
| 0.17049 | 1 |
| 0.1705 | 1 |
| 0.17051 | 1 |
| 0.17052 | 1 |
| 0.17053 | 1 |
| 0.17054 | 1 |
| 0.17055 | 1 |
| 0.17056 | 1 |
| 0.17057 | 1 |
| 0.17058 | 1 |
| 0.17059 | 1 |
| 0.1706 | 1 |
| 0.17061 | 1 |
| 0.17062 | 1 |
| 0.17063 | 1 |
| 0.17064 | 1 |
| 0.17065 | 1 |
| 0.17066 | 1 |
| 0.17067 | 1 |
| 0.17068 | 1 |
| 0.17069 | 1 |
| 0.1707 | 1 |
| 0.17071 | 1 |
| 0.17072 | 1 |
| 0.17073 | 1 |
| 0.17074 | 1 |
| 0.17075 | 1 |
| 0.17076 | 1 |
| 0.17077 | 1 |
| 0.17078 | 1 |
| 0.17079 | 1 |
| 0.1708 | 1 |
| 0.17081 | 1 |
| 0.17082 | 1 |
| 0.17083 | 1 |
| 0.17084 | 1 |
| 0.17085 | 1 |
| 0.17086 | 1 |
| 0.17087 | 1 |
| 0.17088 | 1 |
| 0.17089 | 1 |
| 0.1709 | 1 |
| 0.17091 | 1 |
| 0.17092 | 1 |
| 0.17093 | 1 |
| 0.17094 | 1 |
| 0.17095 | 1 |
| 0.17096 | 1 |
| 0.17097 | 1 |
| 0.17098 | 1 |
| 0.17099 | 1 |
| 0.171 | 1 |
| 0.17101 | 1 |
| 0.17102 | 1 |
| 0.17103 | 1 |
| 0.17104 | 1 |
| 0.17105 | 1 |
| 0.17106 | 1 |
| 0.17107 | 1 |
| 0.17108 | 1 |
| 0.17109 | 1 |
| 0.1711 | 1 |
| 0.17111 | 1 |
| 0.17112 | 1 |
| 0.17113 | 1 |
| 0.17114 | 1 |
| 0.17115 | 1 |
| 0.17116 | 1 |
| 0.17117 | 1 |
| 0.17118 | 1 |
| 0.17119 | 1 |
| 0.1712 | 1 |
| 0.17121 | 1 |
| 0.17122 | 1 |
| 0.17123 | 1 |
| 0.17124 | 1 |
| 0.17125 | 1 |
| 0.17126 | 1 |
| 0.17127 | 1 |
| 0.17128 | 1 |
| 0.17129 | 1 |
| 0.1713 | 1 |
| 0.17131 | 1 |
| 0.17132 | 1 |
| 0.17133 | 1 |
| 0.17134 | 1 |
| 0.17135 | 1 |
| 0.17136 | 1 |
| 0.17137 | 1 |
| 0.17138 | 1 |
| 0.17139 | 1 |
| 0.1714 | 1 |
| 0.17141 | 1 |
| 0.17142 | 1 |
| 0.17143 | 1 |
| 0.17144 | 1 |
| 0.17145 | 1 |
| 0.17146 | 1 |
| 0.17147 | 1 |
| 0.17148 | 1 |
| 0.17149 | 1 |
| 0.1715 | 1 |
| 0.17151 | 1 |
| 0.17152 | 1 |
| 0.17153 | 1 |
| 0.17154 | 1 |
| 0.17155 | 1 |
| 0.17156 | 1 |
| 0.17157 | 1 |
| 0.17158 | 1 |
| 0.17159 | 1 |
| 0.1716 | 1 |
| 0.17161 | 1 |
| 0.17162 | 1 |
| 0.17163 | 1 |
| 0.17164 | 1 |
| 0.17165 | 1 |
| 0.17166 | 1 |
| 0.17167 | 1 |
| 0.17168 | 1 |
| 0.17169 | 1 |
| 0.1717 | 1 |
| 0.17171 | 1 |
| 0.17172 | 1 |
| 0.17173 | 1 |
| 0.17174 | 1 |
| 0.17175 | 1 |
| 0.17176 | 1 |
| 0.17177 | 1 |
| 0.17178 | 1 |
| 0.17179 | 1 |
| 0.1718 | 1 |
| 0.17181 | 1 |
| 0.17182 | 1 |
| 0.17183 | 1 |
| 0.17184 | 1 |
| 0.17185 | 1 |
| 0.17186 | 1 |
| 0.17187 | 1 |
| 0.17188 | 1 |
| 0.17189 | 1 |
| 0.1719 | 1 |
| 0.17191 | 1 |
| 0.17192 | 1 |
| 0.17193 | 1 |
| 0.17194 | 1 |
| 0.17195 | 1 |
| 0.17196 | 1 |
| 0.17197 | 1 |
| 0.17198 | 1 |
| 0.17199 | 1 |
| 0.172 | 1 |
| 0.17201 | 1 |
| 0.17202 | 1 |
| 0.17203 | 1 |
| 0.17204 | 1 |
| 0.17205 | 1 |
| 0.17206 | 1 |
| 0.17207 | 1 |
| 0.17208 | 1 |
| 0.17209 | 1 |
| 0.1721 | 1 |
| 0.17211 | 1 |
| 0.17212 | 1 |
| 0.17213 | 1 |
| 0.17214 | 1 |
| 0.17215 | 1 |
| 0.17216 | 1 |
| 0.17217 | 1 |
| 0.17218 | 1 |
| 0.17219 | 1 |
| 0.1722 | 1 |
| 0.17221 | 1 |
| 0.17222 | 1 |
| 0.17223 | 1 |
| 0.17224 | 1 |
| 0.17225 | 1 |
| 0.17226 | 1 |
| 0.17227 | 1 |
| 0.17228 | 1 |
| 0.17229 | 1 |
| 0.1723 | 1 |
| 0.17231 | 1 |
| 0.17232 | 1 |
| 0.17233 | 1 |
| 0.17234 | 1 |
| 0.17235 | 1 |
| 0.17236 | 1 |
| 0.17237 | 1 |
| 0.17238 | 1 |
| 0.17239 | 1 |
| 0.1724 | 1 |
| 0.17241 | 1 |
| 0.17242 | 1 |
| 0.17243 | 1 |
| 0.17244 | 1 |
| 0.17245 | 1 |
| 0.17246 | 1 |
| 0.17247 | 1 |
| 0.17248 | 1 |
| 0.17249 | 1 |
| 0.1725 | 1 |
| 0.17251 | 1 |
| 0.17252 | 1 |
| 0.17253 | 1 |
| 0.17254 | 1 |
| 0.17255 | 1 |
| 0.17256 | 1 |
| 0.17257 | 1 |
| 0.17258 | 1 |
| 0.17259 | 1 |
| 0.1726 | 1 |
| 0.17261 | 1 |
| 0.17262 | 1 |
| 0.17263 | 1 |
| 0.17264 | 1 |
| 0.17265 | 1 |
| 0.17266 | 1 |
| 0.17267 | 1 |
| 0.17268 | 1 |
| 0.17269 | 1 |
| 0.1727 | 1 |
| 0.17271 | 1 |
| 0.17272 | 1 |
| 0.17273 | 1 |
| 0.17274 | 1 |
| 0.17275 | 1 |
| 0.17276 | 1 |
| 0.17277 | 1 |
| 0.17278 | 1 |
| 0.17279 | 1 |
| 0.1728 | 1 |
| 0.17281 | 1 |
| 0.17282 | 1 |
| 0.17283 | 1 |
| 0.17284 | 1 |
| 0.17285 | 1 |
| 0.17286 | 1 |
| 0.17287 | 1 |
| 0.17288 | 1 |
| 0.17289 | 1 |
| 0.1729 | 1 |
| 0.17291 | 1 |
| 0.17292 | 1 |
| 0.17293 | 1 |
| 0.17294 | 1 |
| 0.17295 | 1 |
| 0.17296 | 1 |
| 0.17297 | 1 |
| 0.17298 | 1 |
| 0.17299 | 1 |
| 0.173 | 1 |
| 0.17301 | 1 |
| 0.17302 | 1 |
| 0.17303 | 1 |
| 0.17304 | 1 |
| 0.17305 | 1 |
| 0.17306 | 1 |
| 0.17307 | 1 |
| 0.17308 | 1 |
| 0.17309 | 1 |
| 0.1731 | 1 |
| 0.17311 | 1 |
| 0.17312 | 1 |
| 0.17313 | 1 |
| 0.17314 | 1 |
| 0.17315 | 1 |
| 0.17316 | 1 |
| 0.17317 | 1 |
| 0.17318 | 1 |
| 0.17319 | 1 |
| 0.1732 | 1 |
| 0.17321 | 1 |
| 0.17322 | 1 |
| 0.17323 | 1 |
| 0.17324 | 1 |
| 0.17325 | 1 |
| 0.17326 | 1 |
| 0.17327 | 1 |
| 0.17328 | 1 |
| 0.17329 | 1 |
| 0.1733 | 1 |
| 0.17331 | 1 |
| 0.17332 | 1 |
| 0.17333 | 1 |
| 0.17334 | 1 |
| 0.17335 | 1 |
| 0.17336 | 1 |
| 0.17337 | 1 |
| 0.17338 | 1 |
| 0.17339 | 1 |
| 0.1734 | 1 |
| 0.17341 | 1 |
| 0.17342 | 1 |
| 0.17343 | 1 |
| 0.17344 | 1 |
| 0.17345 | 1 |
| 0.17346 | 1 |
| 0.17347 | 1 |
| 0.17348 | 1 |
| 0.17349 | 1 |
| 0.1735 | 1 |
| 0.17351 | 1 |
| 0.17352 | 1 |
| 0.17353 | 1 |
| 0.17354 | 1 |
| 0.17355 | 1 |
| 0.17356 | 1 |
| 0.17357 | 1 |
| 0.17358 | 1 |
| 0.17359 | 1 |
| 0.1736 | 1 |
| 0.17361 | 1 |
| 0.17362 | 1 |
| 0.17363 | 1 |
| 0.17364 | 1 |
| 0.17365 | 1 |
| 0.17366 | 1 |
| 0.17367 | 1 |
| 0.17368 | 1 |
| 0.17369 | 1 |
| 0.1737 | 1 |
| 0.17371 | 1 |
| 0.17372 | 1 |
| 0.17373 | 1 |
| 0.17374 | 1 |
| 0.17375 | 1 |
| 0.17376 | 1 |
| 0.17377 | 1 |
| 0.17378 | 1 |
| 0.17379 | 1 |
| 0.1738 | 1 |
| 0.17381 | 1 |
| 0.17382 | 1 |
| 0.17383 | 1 |
| 0.17384 | 1 |
| 0.17385 | 1 |
| 0.17386 | 1 |
| 0.17387 | 1 |
| 0.17388 | 1 |
| 0.17389 | 1 |
| 0.1739 | 1 |
| 0.17391 | 1 |
| 0.17392 | 1 |
| 0.17393 | 1 |
| 0.17394 | 1 |
| 0.17395 | 1 |
| 0.17396 | 1 |
| 0.17397 | 1 |
| 0.17398 | 1 |
| 0.17399 | 1 |
| 0.174 | 1 |
| 0.17401 | 1 |
| 0.17402 | 1 |
| 0.17403 | 1 |
| 0.17404 | 1 |
| 0.17405 | 1 |
| 0.17406 | 1 |
| 0.17407 | 1 |
| 0.17408 | 1 |
| 0.17409 | 1 |
| 0.1741 | 1 |
| 0.17411 | 1 |
| 0.17412 | 1 |
| 0.17413 | 1 |
| 0.17414 | 1 |
| 0.17415 | 1 |
| 0.17416 | 1 |
| 0.17417 | 1 |
| 0.17418 | 1 |
| 0.17419 | 1 |
| 0.1742 | 1 |
| 0.17421 | 1 |
| 0.17422 | 1 |
| 0.17423 | 1 |
| 0.17424 | 1 |
| 0.17425 | 1 |
| 0.17426 | 1 |
| 0.17427 | 1 |
| 0.17428 | 1 |
| 0.17429 | 1 |
| 0.1743 | 1 |
| 0.17431 | 1 |
| 0.17432 | 1 |
| 0.17433 | 1 |
| 0.17434 | 1 |
| 0.17435 | 1 |
| 0.17436 | 1 |
| 0.17437 | 1 |
| 0.17438 | 1 |
| 0.17439 | 1 |
| 0.1744 | 1 |
| 0.17441 | 1 |
| 0.17442 | 1 |
| 0.17443 | 1 |
| 0.17444 | 1 |
| 0.17445 | 1 |
| 0.17446 | 1 |
| 0.17447 | 1 |
| 0.17448 | 1 |
| 0.17449 | 1 |
| 0.1745 | 1 |
| 0.17451 | 1 |
| 0.17452 | 1 |
| 0.17453 | 1 |
| 0.17454 | 1 |
| 0.17455 | 1 |
| 0.17456 | 1 |
| 0.17457 | 1 |
| 0.17458 | 1 |
| 0.17459 | 1 |
| 0.1746 | 1 |
| 0.17461 | 1 |
| 0.17462 | 1 |
| 0.17463 | 1 |
| 0.17464 | 1 |
| 0.17465 | 1 |
| 0.17466 | 1 |
| 0.17467 | 1 |
| 0.17468 | 1 |
| 0.17469 | 1 |
| 0.1747 | 1 |
| 0.17471 | 1 |
| 0.17472 | 1 |
| 0.17473 | 1 |
| 0.17474 | 1 |
| 0.17475 | 1 |
| 0.17476 | 1 |
| 0.17477 | 1 |
| 0.17478 | 1 |
| 0.17479 | 1 |
| 0.1748 | 1 |
| 0.17481 | 1 |
| 0.17482 | 1 |
| 0.17483 | 1 |
| 0.17484 | 1 |
| 0.17485 | 1 |
| 0.17486 | 1 |
| 0.17487 | 1 |
| 0.17488 | 1 |
| 0.17489 | 1 |
| 0.1749 | 1 |
| 0.17491 | 1 |
| 0.17492 | 1 |
| 0.17493 | 1 |
| 0.17494 | 1 |
| 0.17495 | 1 |
| 0.17496 | 1 |
| 0.17497 | 1 |
| 0.17498 | 1 |
| 0.17499 | 1 |
| 0.175 | 1 |
| 0.17501 | 1 |
| 0.17502 | 1 |
| 0.17503 | 1 |
| 0.17504 | 1 |
| 0.17505 | 1 |
| 0.17506 | 1 |
| 0.17507 | 1 |
| 0.17508 | 1 |
| 0.17509 | 1 |
| 0.1751 | 1 |
| 0.17511 | 1 |
| 0.17512 | 1 |
| 0.17513 | 1 |
| 0.17514 | 1 |
| 0.17515 | 1 |
| 0.17516 | 1 |
| 0.17517 | 1 |
| 0.17518 | 1 |
| 0.17519 | 1 |
| 0.1752 | 1 |
| 0.17521 | 1 |
| 0.17522 | 1 |
| 0.17523 | 1 |
| 0.17524 | 1 |
| 0.17525 | 1 |
| 0.17526 | 1 |
| 0.17527 | 1 |
| 0.17528 | 1 |
| 0.17529 | 1 |
| 0.1753 | 1 |
| 0.17531 | 1 |
| 0.17532 | 1 |
| 0.17533 | 1 |
| 0.17534 | 1 |
| 0.17535 | 1 |
| 0.17536 | 1 |
| 0.17537 | 1 |
| 0.17538 | 1 |
| 0.17539 | 1 |
| 0.1754 | 1 |
| 0.17541 | 1 |
| 0.17542 | 1 |
| 0.17543 | 1 |
| 0.17544 | 1 |
| 0.17545 | 1 |
| 0.17546 | 1 |
| 0.17547 | 1 |
| 0.17548 | 1 |
| 0.17549 | 1 |
| 0.1755 | 1 |
| 0.17551 | 1 |
| 0.17552 | 1 |
| 0.17553 | 1 |
| 0.17554 | 1 |
| 0.17555 | 1 |
| 0.17556 | 1 |
| 0.17557 | 1 |
| 0.17558 | 1 |
| 0.17559 | 1 |
| 0.1756 | 1 |
| 0.17561 | 1 |
| 0.17562 | 1 |
| 0.17563 | 1 |
| 0.17564 | 1 |
| 0.17565 | 1 |
| 0.17566 | 1 |
| 0.17567 | 1 |
| 0.17568 | 1 |
| 0.17569 | 1 |
| 0.1757 | 1 |
| 0.17571 | 1 |
| 0.17572 | 1 |
| 0.17573 | 1 |
| 0.17574 | 1 |
| 0.17575 | 1 |
| 0.17576 | 1 |
| 0.17577 | 1 |
| 0.17578 | 1 |
| 0.17579 | 1 |
| 0.1758 | 1 |
| 0.17581 | 1 |
| 0.17582 | 1 |
| 0.17583 | 1 |
| 0.17584 | 1 |
| 0.17585 | 1 |
| 0.17586 | 1 |
| 0.17587 | 1 |
| 0.17588 | 1 |
| 0.17589 | 1 |
| 0.1759 | 1 |
| 0.17591 | 1 |
| 0.17592 | 1 |
| 0.17593 | 1 |
| 0.17594 | 1 |
| 0.17595 | 1 |
| 0.17596 | 1 |
| 0.17597 | 1 |
| 0.17598 | 1 |
| 0.17599 | 1 |
| 0.176 | 1 |
| 0.17601 | 1 |
| 0.17602 | 1 |
| 0.17603 | 1 |
| 0.17604 | 1 |
| 0.17605 | 1 |
| 0.17606 | 1 |
| 0.17607 | 1 |
| 0.17608 | 1 |
| 0.17609 | 1 |
| 0.1761 | 1 |
| 0.17611 | 1 |
| 0.17612 | 1 |
| 0.17613 | 1 |
| 0.17614 | 1 |
| 0.17615 | 1 |
| 0.17616 | 1 |
| 0.17617 | 1 |
| 0.17618 | 1 |
| 0.17619 | 1 |
| 0.1762 | 1 |
| 0.17621 | 1 |
| 0.17622 | 1 |
| 0.17623 | 1 |
| 0.17624 | 1 |
| 0.17625 | 1 |
| 0.17626 | 1 |
| 0.17627 | 1 |
| 0.17628 | 1 |
| 0.17629 | 1 |
| 0.1763 | 1 |
| 0.17631 | 1 |
| 0.17632 | 1 |
| 0.17633 | 1 |
| 0.17634 | 1 |
| 0.17635 | 1 |
| 0.17636 | 1 |
| 0.17637 | 1 |
| 0.17638 | 1 |
| 0.17639 | 1 |
| 0.1764 | 1 |
| 0.17641 | 1 |
| 0.17642 | 1 |
| 0.17643 | 1 |
| 0.17644 | 1 |
| 0.17645 | 1 |
| 0.17646 | 1 |
| 0.17647 | 1 |
| 0.17648 | 1 |
| 0.17649 | 1 |
| 0.1765 | 1 |
| 0.17651 | 1 |
| 0.17652 | 1 |
| 0.17653 | 1 |
| 0.17654 | 1 |
| 0.17655 | 1 |
| 0.17656 | 1 |
| 0.17657 | 1 |
| 0.17658 | 1 |
| 0.17659 | 1 |
| 0.1766 | 1 |
| 0.17661 | 1 |
| 0.17662 | 1 |
| 0.17663 | 1 |
| 0.17664 | 1 |
| 0.17665 | 1 |
| 0.17666 | 1 |
| 0.17667 | 1 |
| 0.17668 | 1 |
| 0.17669 | 1 |
| 0.1767 | 1 |
| 0.17671 | 1 |
| 0.17672 | 1 |
| 0.17673 | 1 |
| 0.17674 | 1 |
| 0.17675 | 1 |
| 0.17676 | 1 |
| 0.17677 | 1 |
| 0.17678 | 1 |
| 0.17679 | 1 |
| 0.1768 | 1 |
| 0.17681 | 1 |
| 0.17682 | 1 |
| 0.17683 | 1 |
| 0.17684 | 1 |
| 0.17685 | 1 |
| 0.17686 | 1 |
| 0.17687 | 1 |
| 0.17688 | 1 |
| 0.17689 | 1 |
| 0.1769 | 1 |
| 0.17691 | 1 |
| 0.17692 | 1 |
| 0.17693 | 1 |
| 0.17694 | 1 |
| 0.17695 | 1 |
| 0.17696 | 1 |
| 0.17697 | 1 |
| 0.17698 | 1 |
| 0.17699 | 1 |
| 0.177 | 1 |
| 0.17701 | 1 |
| 0.17702 | 1 |
| 0.17703 | 1 |
| 0.17704 | 1 |
| 0.17705 | 1 |
| 0.17706 | 1 |
| 0.17707 | 1 |
| 0.17708 | 1 |
| 0.17709 | 1 |
| 0.1771 | 1 |
| 0.17711 | 1 |
| 0.17712 | 1 |
| 0.17713 | 1 |
| 0.17714 | 1 |
| 0.17715 | 1 |
| 0.17716 | 1 |
| 0.17717 | 1 |
| 0.17718 | 1 |
| 0.17719 | 1 |
| 0.1772 | 1 |
| 0.17721 | 1 |
| 0.17722 | 1 |
| 0.17723 | 1 |
| 0.17724 | 1 |
| 0.17725 | 1 |
| 0.17726 | 1 |
| 0.17727 | 1 |
| 0.17728 | 1 |
| 0.17729 | 1 |
| 0.1773 | 1 |
| 0.17731 | 1 |
| 0.17732 | 1 |
| 0.17733 | 1 |
| 0.17734 | 1 |
| 0.17735 | 1 |
| 0.17736 | 1 |
| 0.17737 | 1 |
| 0.17738 | 1 |
| 0.17739 | 1 |
| 0.1774 | 1 |
| 0.17741 | 1 |
| 0.17742 | 1 |
| 0.17743 | 1 |
| 0.17744 | 1 |
| 0.17745 | 1 |
| 0.17746 | 1 |
| 0.17747 | 1 |
| 0.17748 | 1 |
| 0.17749 | 1 |
| 0.1775 | 1 |
| 0.17751 | 1 |
| 0.17752 | 1 |
| 0.17753 | 1 |
| 0.17754 | 1 |
| 0.17755 | 1 |
| 0.17756 | 1 |
| 0.17757 | 1 |
| 0.17758 | 1 |
| 0.17759 | 1 |
| 0.1776 | 1 |
| 0.17761 | 1 |
| 0.17762 | 1 |
| 0.17763 | 1 |
| 0.17764 | 1 |
| 0.17765 | 1 |
| 0.17766 | 1 |
| 0.17767 | 1 |
| 0.17768 | 1 |
| 0.17769 | 1 |
| 0.1777 | 1 |
| 0.17771 | 1 |
| 0.17772 | 1 |
| 0.17773 | 1 |
| 0.17774 | 1 |
| 0.17775 | 1 |
| 0.17776 | 1 |
| 0.17777 | 1 |
| 0.17778 | 1 |
| 0.17779 | 1 |
| 0.1778 | 1 |
| 0.17781 | 1 |
| 0.17782 | 1 |
| 0.17783 | 1 |
| 0.17784 | 1 |
| 0.17785 | 1 |
| 0.17786 | 1 |
| 0.17787 | 1 |
| 0.17788 | 1 |
| 0.17789 | 1 |
| 0.1779 | 1 |
| 0.17791 | 1 |
| 0.17792 | 1 |
| 0.17793 | 1 |
| 0.17794 | 1 |
| 0.17795 | 1 |
| 0.17796 | 1 |
| 0.17797 | 1 |
| 0.17798 | 1 |
| 0.17799 | 1 |
| 0.178 | 1 |
| 0.17801 | 1 |
| 0.17802 | 1 |
| 0.17803 | 1 |
| 0.17804 | 1 |
| 0.17805 | 1 |
| 0.17806 | 1 |
| 0.17807 | 1 |
| 0.17808 | 1 |
| 0.17809 | 1 |
| 0.1781 | 1 |
| 0.17811 | 1 |
| 0.17812 | 1 |
| 0.17813 | 1 |
| 0.17814 | 1 |
| 0.17815 | 1 |
| 0.17816 | 1 |
| 0.17817 | 1 |
| 0.17818 | 1 |
| 0.17819 | 1 |
| 0.1782 | 1 |
| 0.17821 | 1 |
| 0.17822 | 1 |
| 0.17823 | 1 |
| 0.17824 | 1 |
| 0.17825 | 1 |
| 0.17826 | 1 |
| 0.17827 | 1 |
| 0.17828 | 1 |
| 0.17829 | 1 |
| 0.1783 | 1 |
| 0.17831 | 1 |
| 0.17832 | 1 |
| 0.17833 | 1 |
| 0.17834 | 1 |
| 0.17835 | 1 |
| 0.17836 | 1 |
| 0.17837 | 1 |
| 0.17838 | 1 |
| 0.17839 | 1 |
| 0.1784 | 1 |
| 0.17841 | 1 |
| 0.17842 | 1 |
| 0.17843 | 1 |
| 0.17844 | 1 |
| 0.17845 | 1 |
| 0.17846 | 1 |
| 0.17847 | 1 |
| 0.17848 | 1 |
| 0.17849 | 1 |
| 0.1785 | 1 |
| 0.17851 | 1 |
| 0.17852 | 1 |
| 0.17853 | 1 |
| 0.17854 | 1 |
| 0.17855 | 1 |
| 0.17856 | 1 |
| 0.17857 | 1 |
| 0.17858 | 1 |
| 0.17859 | 1 |
| 0.1786 | 1 |
| 0.17861 | 1 |
| 0.17862 | 1 |
| 0.17863 | 1 |
| 0.17864 | 1 |
| 0.17865 | 1 |
| 0.17866 | 1 |
| 0.17867 | 1 |
| 0.17868 | 1 |
| 0.17869 | 1 |
| 0.1787 | 1 |
| 0.17871 | 1 |
| 0.17872 | 1 |
| 0.17873 | 1 |
| 0.17874 | 1 |
| 0.17875 | 1 |
| 0.17876 | 1 |
| 0.17877 | 1 |
| 0.17878 | 1 |
| 0.17879 | 1 |
| 0.1788 | 1 |
| 0.17881 | 1 |
| 0.17882 | 1 |
| 0.17883 | 1 |
| 0.17884 | 1 |
| 0.17885 | 1 |
| 0.17886 | 1 |
| 0.17887 | 1 |
| 0.17888 | 1 |
| 0.17889 | 1 |
| 0.1789 | 1 |
| 0.17891 | 1 |
| 0.17892 | 1 |
| 0.17893 | 1 |
| 0.17894 | 1 |
| 0.17895 | 1 |
| 0.17896 | 1 |
| 0.17897 | 1 |
| 0.17898 | 1 |
| 0.17899 | 1 |
| 0.179 | 1 |
| 0.17901 | 1 |
| 0.17902 | 1 |
| 0.17903 | 1 |
| 0.17904 | 1 |
| 0.17905 | 1 |
| 0.17906 | 1 |
| 0.17907 | 1 |
| 0.17908 | 1 |
| 0.17909 | 1 |
| 0.1791 | 1 |
| 0.17911 | 1 |
| 0.17912 | 1 |
| 0.17913 | 1 |
| 0.17914 | 1 |
| 0.17915 | 1 |
| 0.17916 | 1 |
| 0.17917 | 1 |
| 0.17918 | 1 |
| 0.17919 | 1 |
| 0.1792 | 1 |
| 0.17921 | 1 |
| 0.17922 | 1 |
| 0.17923 | 1 |
| 0.17924 | 1 |
| 0.17925 | 1 |
| 0.17926 | 1 |
| 0.17927 | 1 |
| 0.17928 | 1 |
| 0.17929 | 1 |
| 0.1793 | 1 |
| 0.17931 | 1 |
| 0.17932 | 1 |
| 0.17933 | 1 |
| 0.17934 | 1 |
| 0.17935 | 1 |
| 0.17936 | 1 |
| 0.17937 | 1 |
| 0.17938 | 1 |
| 0.17939 | 1 |
| 0.1794 | 1 |
| 0.17941 | 1 |
| 0.17942 | 1 |
| 0.17943 | 1 |
| 0.17944 | 1 |
| 0.17945 | 1 |
| 0.17946 | 1 |
| 0.17947 | 1 |
| 0.17948 | 1 |
| 0.17949 | 1 |
| 0.1795 | 1 |
| 0.17951 | 1 |
| 0.17952 | 1 |
| 0.17953 | 1 |
| 0.17954 | 1 |
| 0.17955 | 1 |
| 0.17956 | 1 |
| 0.17957 | 1 |
| 0.17958 | 1 |
| 0.17959 | 1 |
| 0.1796 | 1 |
| 0.17961 | 1 |
| 0.17962 | 1 |
| 0.17963 | 1 |
| 0.17964 | 1 |
| 0.17965 | 1 |
| 0.17966 | 1 |
| 0.17967 | 1 |
| 0.17968 | 1 |
| 0.17969 | 1 |
| 0.1797 | 1 |
| 0.17971 | 1 |
| 0.17972 | 1 |
| 0.17973 | 1 |
| 0.17974 | 1 |
| 0.17975 | 1 |
| 0.17976 | 1 |
| 0.17977 | 1 |
| 0.17978 | 1 |
| 0.17979 | 1 |
| 0.1798 | 1 |
| 0.17981 | 1 |
| 0.17982 | 1 |
| 0.17983 | 1 |
| 0.17984 | 1 |
| 0.17985 | 1 |
| 0.17986 | 1 |
| 0.17987 | 1 |
| 0.17988 | 1 |
| 0.17989 | 1 |
| 0.1799 | 1 |
| 0.17991 | 1 |
| 0.17992 | 1 |
| 0.17993 | 1 |
| 0.17994 | 1 |
| 0.17995 | 1 |
| 0.17996 | 1 |
| 0.17997 | 1 |
| 0.17998 | 1 |
| 0.17999 | 1 |
| 0.18 | 1 |
| 0.18001 | 1 |
| 0.18002 | 1 |
| 0.18003 | 1 |
| 0.18004 | 1 |
| 0.18005 | 1 |
| 0.18006 | 1 |
| 0.18007 | 1 |
| 0.18008 | 1 |
| 0.18009 | 1 |
| 0.1801 | 1 |
| 0.18011 | 1 |
| 0.18012 | 1 |
| 0.18013 | 1 |
| 0.18014 | 1 |
| 0.18015 | 1 |
| 0.18016 | 1 |
| 0.18017 | 1 |
| 0.18018 | 1 |
| 0.18019 | 1 |
| 0.1802 | 1 |
| 0.18021 | 1 |
| 0.18022 | 1 |
| 0.18023 | 1 |
| 0.18024 | 1 |
| 0.18025 | 1 |
| 0.18026 | 1 |
| 0.18027 | 1 |
| 0.18028 | 1 |
| 0.18029 | 1 |
| 0.1803 | 1 |
| 0.18031 | 1 |
| 0.18032 | 1 |
| 0.18033 | 1 |
| 0.18034 | 1 |
| 0.18035 | 1 |
| 0.18036 | 1 |
| 0.18037 | 1 |
| 0.18038 | 1 |
| 0.18039 | 1 |
| 0.1804 | 1 |
| 0.18041 | 1 |
| 0.18042 | 1 |
| 0.18043 | 1 |
| 0.18044 | 1 |
| 0.18045 | 1 |
| 0.18046 | 1 |
| 0.18047 | 1 |
| 0.18048 | 1 |
| 0.18049 | 1 |
| 0.1805 | 1 |
| 0.18051 | 1 |
| 0.18052 | 1 |
| 0.18053 | 1 |
| 0.18054 | 1 |
| 0.18055 | 1 |
| 0.18056 | 1 |
| 0.18057 | 1 |
| 0.18058 | 1 |
| 0.18059 | 1 |
| 0.1806 | 1 |
| 0.18061 | 1 |
| 0.18062 | 1 |
| 0.18063 | 1 |
| 0.18064 | 1 |
| 0.18065 | 1 |
| 0.18066 | 1 |
| 0.18067 | 1 |
| 0.18068 | 1 |
| 0.18069 | 1 |
| 0.1807 | 1 |
| 0.18071 | 1 |
| 0.18072 | 1 |
| 0.18073 | 1 |
| 0.18074 | 1 |
| 0.18075 | 1 |
| 0.18076 | 1 |
| 0.18077 | 1 |
| 0.18078 | 1 |
| 0.18079 | 1 |
| 0.1808 | 1 |
| 0.18081 | 1 |
| 0.18082 | 1 |
| 0.18083 | 1 |
| 0.18084 | 1 |
| 0.18085 | 1 |
| 0.18086 | 1 |
| 0.18087 | 1 |
| 0.18088 | 1 |
| 0.18089 | 1 |
| 0.1809 | 1 |
| 0.18091 | 1 |
| 0.18092 | 1 |
| 0.18093 | 1 |
| 0.18094 | 1 |
| 0.18095 | 1 |
| 0.18096 | 1 |
| 0.18097 | 1 |
| 0.18098 | 1 |
| 0.18099 | 1 |
| 0.181 | 1 |
| 0.18101 | 1 |
| 0.18102 | 1 |
| 0.18103 | 1 |
| 0.18104 | 1 |
| 0.18105 | 1 |
| 0.18106 | 1 |
| 0.18107 | 1 |
| 0.18108 | 1 |
| 0.18109 | 1 |
| 0.1811 | 1 |
| 0.18111 | 1 |
| 0.18112 | 1 |
| 0.18113 | 1 |
| 0.18114 | 1 |
| 0.18115 | 1 |
| 0.18116 | 1 |
| 0.18117 | 1 |
| 0.18118 | 1 |
| 0.18119 | 1 |
| 0.1812 | 1 |
| 0.18121 | 1 |
| 0.18122 | 1 |
| 0.18123 | 1 |
| 0.18124 | 1 |
| 0.18125 | 1 |
| 0.18126 | 1 |
| 0.18127 | 1 |
| 0.18128 | 1 |
| 0.18129 | 1 |
| 0.1813 | 1 |
| 0.18131 | 1 |
| 0.18132 | 1 |
| 0.18133 | 1 |
| 0.18134 | 1 |
| 0.18135 | 1 |
| 0.18136 | 1 |
| 0.18137 | 1 |
| 0.18138 | 1 |
| 0.18139 | 1 |
| 0.1814 | 1 |
| 0.18141 | 1 |
| 0.18142 | 1 |
| 0.18143 | 1 |
| 0.18144 | 1 |
| 0.18145 | 1 |
| 0.18146 | 1 |
| 0.18147 | 1 |
| 0.18148 | 1 |
| 0.18149 | 1 |
| 0.1815 | 1 |
| 0.18151 | 1 |
| 0.18152 | 1 |
| 0.18153 | 1 |
| 0.18154 | 1 |
| 0.18155 | 1 |
| 0.18156 | 1 |
| 0.18157 | 1 |
| 0.18158 | 1 |
| 0.18159 | 1 |
| 0.1816 | 1 |
| 0.18161 | 1 |
| 0.18162 | 1 |
| 0.18163 | 1 |
| 0.18164 | 1 |
| 0.18165 | 1 |
| 0.18166 | 1 |
| 0.18167 | 1 |
| 0.18168 | 1 |
| 0.18169 | 1 |
| 0.1817 | 1 |
| 0.18171 | 1 |
| 0.18172 | 1 |
| 0.18173 | 1 |
| 0.18174 | 1 |
| 0.18175 | 1 |
| 0.18176 | 1 |
| 0.18177 | 1 |
| 0.18178 | 1 |
| 0.18179 | 1 |
| 0.1818 | 1 |
| 0.18181 | 1 |
| 0.18182 | 1 |
| 0.18183 | 1 |
| 0.18184 | 1 |
| 0.18185 | 1 |
| 0.18186 | 1 |
| 0.18187 | 1 |
| 0.18188 | 1 |
| 0.18189 | 1 |
| 0.1819 | 1 |
| 0.18191 | 1 |
| 0.18192 | 1 |
| 0.18193 | 1 |
| 0.18194 | 1 |
| 0.18195 | 1 |
| 0.18196 | 1 |
| 0.18197 | 1 |
| 0.18198 | 1 |
| 0.18199 | 1 |
| 0.182 | 1 |
| 0.18201 | 1 |
| 0.18202 | 1 |
| 0.18203 | 1 |
| 0.18204 | 1 |
| 0.18205 | 1 |
| 0.18206 | 1 |
| 0.18207 | 1 |
| 0.18208 | 1 |
| 0.18209 | 1 |
| 0.1821 | 1 |
| 0.18211 | 1 |
| 0.18212 | 1 |
| 0.18213 | 1 |
| 0.18214 | 1 |
| 0.18215 | 1 |
| 0.18216 | 1 |
| 0.18217 | 1 |
| 0.18218 | 1 |
| 0.18219 | 1 |
| 0.1822 | 1 |
| 0.18221 | 1 |
| 0.18222 | 1 |
| 0.18223 | 1 |
| 0.18224 | 1 |
| 0.18225 | 1 |
| 0.18226 | 1 |
| 0.18227 | 1 |
| 0.18228 | 1 |
| 0.18229 | 1 |
| 0.1823 | 1 |
| 0.18231 | 1 |
| 0.18232 | 1 |
| 0.18233 | 1 |
| 0.18234 | 1 |
| 0.18235 | 1 |
| 0.18236 | 1 |
| 0.18237 | 1 |
| 0.18238 | 1 |
| 0.18239 | 1 |
| 0.1824 | 1 |
| 0.18241 | 1 |
| 0.18242 | 1 |
| 0.18243 | 1 |
| 0.18244 | 1 |
| 0.18245 | 1 |
| 0.18246 | 1 |
| 0.18247 | 1 |
| 0.18248 | 1 |
| 0.18249 | 1 |
| 0.1825 | 1 |
| 0.18251 | 1 |
| 0.18252 | 1 |
| 0.18253 | 1 |
| 0.18254 | 1 |
| 0.18255 | 1 |
| 0.18256 | 1 |
| 0.18257 | 1 |
| 0.18258 | 1 |
| 0.18259 | 1 |
| 0.1826 | 1 |
| 0.18261 | 1 |
| 0.18262 | 1 |
| 0.18263 | 1 |
| 0.18264 | 1 |
| 0.18265 | 1 |
| 0.18266 | 1 |
| 0.18267 | 1 |
| 0.18268 | 1 |
| 0.18269 | 1 |
| 0.1827 | 1 |
| 0.18271 | 1 |
| 0.18272 | 1 |
| 0.18273 | 1 |
| 0.18274 | 1 |
| 0.18275 | 1 |
| 0.18276 | 1 |
| 0.18277 | 1 |
| 0.18278 | 1 |
| 0.18279 | 1 |
| 0.1828 | 1 |
| 0.18281 | 1 |
| 0.18282 | 1 |
| 0.18283 | 1 |
| 0.18284 | 1 |
| 0.18285 | 1 |
| 0.18286 | 1 |
| 0.18287 | 1 |
| 0.18288 | 1 |
| 0.18289 | 1 |
| 0.1829 | 1 |
| 0.18291 | 1 |
| 0.18292 | 1 |
| 0.18293 | 1 |
| 0.18294 | 1 |
| 0.18295 | 1 |
| 0.18296 | 1 |
| 0.18297 | 1 |
| 0.18298 | 1 |
| 0.18299 | 1 |
| 0.183 | 1 |
| 0.18301 | 1 |
| 0.18302 | 1 |
| 0.18303 | 1 |
| 0.18304 | 1 |
| 0.18305 | 1 |
| 0.18306 | 1 |
| 0.18307 | 1 |
| 0.18308 | 1 |
| 0.18309 | 1 |
| 0.1831 | 1 |
| 0.18311 | 1 |
| 0.18312 | 1 |
| 0.18313 | 1 |
| 0.18314 | 1 |
| 0.18315 | 1 |
| 0.18316 | 1 |
| 0.18317 | 1 |
| 0.18318 | 1 |
| 0.18319 | 1 |
| 0.1832 | 1 |
| 0.18321 | 1 |
| 0.18322 | 1 |
| 0.18323 | 1 |
| 0.18324 | 1 |
| 0.18325 | 1 |
| 0.18326 | 1 |
| 0.18327 | 1 |
| 0.18328 | 1 |
| 0.18329 | 1 |
| 0.1833 | 1 |
| 0.18331 | 1 |
| 0.18332 | 1 |
| 0.18333 | 1 |
| 0.18334 | 1 |
| 0.18335 | 1 |
| 0.18336 | 1 |
| 0.18337 | 1 |
| 0.18338 | 1 |
| 0.18339 | 1 |
| 0.1834 | 1 |
| 0.18341 | 1 |
| 0.18342 | 1 |
| 0.18343 | 1 |
| 0.18344 | 1 |
| 0.18345 | 1 |
| 0.18346 | 1 |
| 0.18347 | 1 |
| 0.18348 | 1 |
| 0.18349 | 1 |
| 0.1835 | 1 |
| 0.18351 | 1 |
| 0.18352 | 1 |
| 0.18353 | 1 |
| 0.18354 | 1 |
| 0.18355 | 1 |
| 0.18356 | 1 |
| 0.18357 | 1 |
| 0.18358 | 1 |
| 0.18359 | 1 |
| 0.1836 | 1 |
| 0.18361 | 1 |
| 0.18362 | 1 |
| 0.18363 | 1 |
| 0.18364 | 1 |
| 0.18365 | 1 |
| 0.18366 | 1 |
| 0.18367 | 1 |
| 0.18368 | 1 |
| 0.18369 | 1 |
| 0.1837 | 1 |
| 0.18371 | 1 |
| 0.18372 | 1 |
| 0.18373 | 1 |
| 0.18374 | 1 |
| 0.18375 | 1 |
| 0.18376 | 1 |
| 0.18377 | 1 |
| 0.18378 | 1 |
| 0.18379 | 1 |
| 0.1838 | 1 |
| 0.18381 | 1 |
| 0.18382 | 1 |
| 0.18383 | 1 |
| 0.18384 | 1 |
| 0.18385 | 1 |
| 0.18386 | 1 |
| 0.18387 | 1 |
| 0.18388 | 1 |
| 0.18389 | 1 |
| 0.1839 | 1 |
| 0.18391 | 1 |
| 0.18392 | 1 |
| 0.18393 | 1 |
| 0.18394 | 1 |
| 0.18395 | 1 |
| 0.18396 | 1 |
| 0.18397 | 1 |
| 0.18398 | 1 |
| 0.18399 | 1 |
| 0.184 | 1 |
| 0.18401 | 1 |
| 0.18402 | 1 |
| 0.18403 | 1 |
| 0.18404 | 1 |
| 0.18405 | 1 |
| 0.18406 | 1 |
| 0.18407 | 1 |
| 0.18408 | 1 |
| 0.18409 | 1 |
| 0.1841 | 1 |
| 0.18411 | 1 |
| 0.18412 | 1 |
| 0.18413 | 1 |
| 0.18414 | 1 |
| 0.18415 | 1 |
| 0.18416 | 1 |
| 0.18417 | 1 |
| 0.18418 | 1 |
| 0.18419 | 1 |
| 0.1842 | 1 |
| 0.18421 | 1 |
| 0.18422 | 1 |
| 0.18423 | 1 |
| 0.18424 | 1 |
| 0.18425 | 1 |
| 0.18426 | 1 |
| 0.18427 | 1 |
| 0.18428 | 1 |
| 0.18429 | 1 |
| 0.1843 | 1 |
| 0.18431 | 1 |
| 0.18432 | 1 |
| 0.18433 | 1 |
| 0.18434 | 1 |
| 0.18435 | 1 |
| 0.18436 | 1 |
| 0.18437 | 1 |
| 0.18438 | 1 |
| 0.18439 | 1 |
| 0.1844 | 1 |
| 0.18441 | 1 |
| 0.18442 | 1 |
| 0.18443 | 1 |
| 0.18444 | 1 |
| 0.18445 | 1 |
| 0.18446 | 1 |
| 0.18447 | 1 |
| 0.18448 | 1 |
| 0.18449 | 1 |
| 0.1845 | 1 |
| 0.18451 | 1 |
| 0.18452 | 1 |
| 0.18453 | 1 |
| 0.18454 | 1 |
| 0.18455 | 1 |
| 0.18456 | 1 |
| 0.18457 | 1 |
| 0.18458 | 1 |
| 0.18459 | 1 |
| 0.1846 | 1 |
| 0.18461 | 1 |
| 0.18462 | 1 |
| 0.18463 | 1 |
| 0.18464 | 1 |
| 0.18465 | 1 |
| 0.18466 | 1 |
| 0.18467 | 1 |
| 0.18468 | 1 |
| 0.18469 | 1 |
| 0.1847 | 1 |
| 0.18471 | 1 |
| 0.18472 | 1 |
| 0.18473 | 1 |
| 0.18474 | 1 |
| 0.18475 | 1 |
| 0.18476 | 1 |
| 0.18477 | 1 |
| 0.18478 | 1 |
| 0.18479 | 1 |
| 0.1848 | 1 |
| 0.18481 | 1 |
| 0.18482 | 1 |
| 0.18483 | 1 |
| 0.18484 | 1 |
| 0.18485 | 1 |
| 0.18486 | 1 |
| 0.18487 | 1 |
| 0.18488 | 1 |
| 0.18489 | 1 |
| 0.1849 | 1 |
| 0.18491 | 1 |
| 0.18492 | 1 |
| 0.18493 | 1 |
| 0.18494 | 1 |
| 0.18495 | 1 |
| 0.18496 | 1 |
| 0.18497 | 1 |
| 0.18498 | 1 |
| 0.18499 | 1 |
| 0.185 | 1 |
| 0.18501 | 1 |
| 0.18502 | 1 |
| 0.18503 | 1 |
| 0.18504 | 1 |
| 0.18505 | 1 |
| 0.18506 | 1 |
| 0.18507 | 1 |
| 0.18508 | 1 |
| 0.18509 | 1 |
| 0.1851 | 1 |
| 0.18511 | 1 |
| 0.18512 | 1 |
| 0.18513 | 1 |
| 0.18514 | 1 |
| 0.18515 | 0.999 |
| 0.18516 | 0.999 |
| 0.18517 | 0.999 |
| 0.18518 | 0.999 |
| 0.18519 | 0.999 |
| 0.1852 | 0.999 |
| 0.18521 | 0.999 |
| 0.18522 | 0.999 |
| 0.18523 | 0.999 |
| 0.18524 | 0.999 |
| 0.18525 | 0.999 |
| 0.18526 | 0.999 |
| 0.18527 | 0.999 |
| 0.18528 | 0.999 |
| 0.18529 | 0.999 |
| 0.1853 | 0.999 |
| 0.18531 | 0.999 |
| 0.18532 | 0.999 |
| 0.18533 | 0.999 |
| 0.18534 | 0.999 |
| 0.18535 | 0.999 |
| 0.18536 | 0.999 |
| 0.18537 | 0.999 |
| 0.18538 | 0.999 |
| 0.18539 | 0.999 |
| 0.1854 | 0.999 |
| 0.18541 | 0.999 |
| 0.18542 | 0.999 |
| 0.18543 | 0.999 |
| 0.18544 | 0.999 |
| 0.18545 | 0.999 |
| 0.18546 | 0.999 |
| 0.18547 | 0.999 |
| 0.18548 | 0.999 |
| 0.18549 | 0.999 |
| 0.1855 | 0.999 |
| 0.18551 | 0.999 |
| 0.18552 | 0.999 |
| 0.18553 | 0.999 |
| 0.18554 | 0.999 |
| 0.18555 | 0.999 |
| 0.18556 | 0.999 |
| 0.18557 | 0.999 |
| 0.18558 | 0.999 |
| 0.18559 | 0.999 |
| 0.1856 | 0.999 |
| 0.18561 | 0.999 |
| 0.18562 | 0.999 |
| 0.18563 | 0.999 |
| 0.18564 | 0.999 |
| 0.18565 | 0.999 |
| 0.18566 | 0.999 |
| 0.18567 | 0.999 |
| 0.18568 | 0.999 |
| 0.18569 | 0.999 |
| 0.1857 | 0.999 |
| 0.18571 | 0.999 |
| 0.18572 | 0.999 |
| 0.18573 | 0.999 |
| 0.18574 | 0.999 |
| 0.18575 | 0.999 |
| 0.18576 | 0.999 |
| 0.18577 | 0.999 |
| 0.18578 | 0.999 |
| 0.18579 | 0.999 |
| 0.1858 | 0.999 |
| 0.18581 | 0.999 |
| 0.18582 | 0.999 |
| 0.18583 | 0.999 |
| 0.18584 | 0.999 |
| 0.18585 | 0.999 |
| 0.18586 | 0.999 |
| 0.18587 | 0.999 |
| 0.18588 | 0.999 |
| 0.18589 | 0.999 |
| 0.1859 | 0.999 |
| 0.18591 | 0.999 |
| 0.18592 | 0.999 |
| 0.18593 | 0.999 |
| 0.18594 | 0.999 |
| 0.18595 | 0.999 |
| 0.18596 | 0.999 |
| 0.18597 | 0.999 |
| 0.18598 | 0.999 |
| 0.18599 | 0.999 |
| 0.186 | 0.999 |
| 0.18601 | 0.999 |
| 0.18602 | 0.999 |
| 0.18603 | 0.999 |
| 0.18604 | 0.999 |
| 0.18605 | 0.999 |
| 0.18606 | 0.999 |
| 0.18607 | 0.999 |
| 0.18608 | 0.999 |
| 0.18609 | 0.999 |
| 0.1861 | 0.999 |
| 0.18611 | 0.999 |
| 0.18612 | 0.999 |
| 0.18613 | 0.999 |
| 0.18614 | 0.999 |
| 0.18615 | 0.999 |
| 0.18616 | 0.999 |
| 0.18617 | 0.999 |
| 0.18618 | 0.999 |
| 0.18619 | 0.999 |
| 0.1862 | 0.999 |
| 0.18621 | 0.999 |
| 0.18622 | 0.999 |
| 0.18623 | 0.999 |
| 0.18624 | 0.999 |
| 0.18625 | 0.999 |
| 0.18626 | 0.999 |
| 0.18627 | 0.999 |
| 0.18628 | 0.999 |
| 0.18629 | 0.999 |
| 0.1863 | 0.999 |
| 0.18631 | 0.999 |
| 0.18632 | 0.999 |
| 0.18633 | 0.999 |
| 0.18634 | 0.999 |
| 0.18635 | 0.999 |
| 0.18636 | 0.999 |
| 0.18637 | 0.999 |
| 0.18638 | 0.999 |
| 0.18639 | 0.999 |
| 0.1864 | 0.999 |
| 0.18641 | 0.999 |
| 0.18642 | 0.999 |
| 0.18643 | 0.999 |
| 0.18644 | 0.999 |
| 0.18645 | 0.999 |
| 0.18646 | 0.999 |
| 0.18647 | 0.999 |
| 0.18648 | 0.999 |
| 0.18649 | 0.999 |
| 0.1865 | 0.999 |
| 0.18651 | 0.999 |
| 0.18652 | 0.999 |
| 0.18653 | 0.999 |
| 0.18654 | 0.999 |
| 0.18655 | 0.999 |
| 0.18656 | 0.999 |
| 0.18657 | 0.999 |
| 0.18658 | 0.999 |
| 0.18659 | 0.999 |
| 0.1866 | 0.999 |
| 0.18661 | 0.999 |
| 0.18662 | 0.999 |
| 0.18663 | 0.999 |
| 0.18664 | 0.999 |
| 0.18665 | 0.999 |
| 0.18666 | 0.999 |
| 0.18667 | 0.999 |
| 0.18668 | 0.999 |
| 0.18669 | 0.999 |
| 0.1867 | 0.999 |
| 0.18671 | 0.999 |
| 0.18672 | 0.999 |
| 0.18673 | 0.999 |
| 0.18674 | 0.999 |
| 0.18675 | 0.999 |
| 0.18676 | 0.999 |
| 0.18677 | 0.999 |
| 0.18678 | 0.999 |
| 0.18679 | 0.999 |
| 0.1868 | 0.999 |
| 0.18681 | 0.999 |
| 0.18682 | 0.999 |
| 0.18683 | 0.999 |
| 0.18684 | 0.999 |
| 0.18685 | 0.999 |
| 0.18686 | 0.999 |
| 0.18687 | 0.999 |
| 0.18688 | 0.999 |
| 0.18689 | 0.999 |
| 0.1869 | 0.999 |
| 0.18691 | 0.999 |
| 0.18692 | 0.999 |
| 0.18693 | 0.999 |
| 0.18694 | 0.999 |
| 0.18695 | 0.999 |
| 0.18696 | 0.999 |
| 0.18697 | 0.999 |
| 0.18698 | 0.999 |
| 0.18699 | 0.999 |
| 0.187 | 0.999 |
| 0.18701 | 0.999 |
| 0.18702 | 0.999 |
| 0.18703 | 0.999 |
| 0.18704 | 0.999 |
| 0.18705 | 0.999 |
| 0.18706 | 0.999 |
| 0.18707 | 0.999 |
| 0.18708 | 0.999 |
| 0.18709 | 0.999 |
| 0.1871 | 0.999 |
| 0.18711 | 0.999 |
| 0.18712 | 0.999 |
| 0.18713 | 0.999 |
| 0.18714 | 0.999 |
| 0.18715 | 0.999 |
| 0.18716 | 0.999 |
| 0.18717 | 0.999 |
| 0.18718 | 0.999 |
| 0.18719 | 0.999 |
| 0.1872 | 0.999 |
| 0.18721 | 0.999 |
| 0.18722 | 0.999 |
| 0.18723 | 0.999 |
| 0.18724 | 0.999 |
| 0.18725 | 0.999 |
| 0.18726 | 0.999 |
| 0.18727 | 0.999 |
| 0.18728 | 0.999 |
| 0.18729 | 0.999 |
| 0.1873 | 0.999 |
| 0.18731 | 0.999 |
| 0.18732 | 0.999 |
| 0.18733 | 0.999 |
| 0.18734 | 0.999 |
| 0.18735 | 0.999 |
| 0.18736 | 0.999 |
| 0.18737 | 0.999 |
| 0.18738 | 0.999 |
| 0.18739 | 0.999 |
| 0.1874 | 0.999 |
| 0.18741 | 0.999 |
| 0.18742 | 0.999 |
| 0.18743 | 0.999 |
| 0.18744 | 0.999 |
| 0.18745 | 0.999 |
| 0.18746 | 0.999 |
| 0.18747 | 0.999 |
| 0.18748 | 0.999 |
| 0.18749 | 0.999 |
| 0.1875 | 0.999 |
| 0.18751 | 0.999 |
| 0.18752 | 0.999 |
| 0.18753 | 0.999 |
| 0.18754 | 0.999 |
| 0.18755 | 0.999 |
| 0.18756 | 0.999 |
| 0.18757 | 0.999 |
| 0.18758 | 0.999 |
| 0.18759 | 0.999 |
| 0.1876 | 0.999 |
| 0.18761 | 0.999 |
| 0.18762 | 0.999 |
| 0.18763 | 0.999 |
| 0.18764 | 0.999 |
| 0.18765 | 0.999 |
| 0.18766 | 0.999 |
| 0.18767 | 0.999 |
| 0.18768 | 0.999 |
| 0.18769 | 0.999 |
| 0.1877 | 0.999 |
| 0.18771 | 0.999 |
| 0.18772 | 0.999 |
| 0.18773 | 0.999 |
| 0.18774 | 0.999 |
| 0.18775 | 0.999 |
| 0.18776 | 0.999 |
| 0.18777 | 0.999 |
| 0.18778 | 0.999 |
| 0.18779 | 0.999 |
| 0.1878 | 0.999 |
| 0.18781 | 0.999 |
| 0.18782 | 0.999 |
| 0.18783 | 0.999 |
| 0.18784 | 0.999 |
| 0.18785 | 0.999 |
| 0.18786 | 0.999 |
| 0.18787 | 0.999 |
| 0.18788 | 0.999 |
| 0.18789 | 0.999 |
| 0.1879 | 0.999 |
| 0.18791 | 0.999 |
| 0.18792 | 0.999 |
| 0.18793 | 0.999 |
| 0.18794 | 0.999 |
| 0.18795 | 0.999 |
| 0.18796 | 0.999 |
| 0.18797 | 0.999 |
| 0.18798 | 0.999 |
| 0.18799 | 0.999 |
| 0.188 | 0.999 |
| 0.18801 | 0.999 |
| 0.18802 | 0.999 |
| 0.18803 | 0.999 |
| 0.18804 | 0.999 |
| 0.18805 | 0.999 |
| 0.18806 | 0.999 |
| 0.18807 | 0.999 |
| 0.18808 | 0.999 |
| 0.18809 | 0.999 |
| 0.1881 | 0.999 |
| 0.18811 | 0.999 |
| 0.18812 | 0.999 |
| 0.18813 | 0.999 |
| 0.18814 | 0.999 |
| 0.18815 | 0.999 |
| 0.18816 | 0.999 |
| 0.18817 | 0.999 |
| 0.18818 | 0.999 |
| 0.18819 | 0.999 |
| 0.1882 | 0.999 |
| 0.18821 | 0.999 |
| 0.18822 | 0.999 |
| 0.18823 | 0.999 |
| 0.18824 | 0.999 |
| 0.18825 | 0.999 |
| 0.18826 | 0.999 |
| 0.18827 | 0.999 |
| 0.18828 | 0.999 |
| 0.18829 | 0.999 |
| 0.1883 | 0.999 |
| 0.18831 | 0.999 |
| 0.18832 | 0.999 |
| 0.18833 | 0.999 |
| 0.18834 | 0.999 |
| 0.18835 | 0.999 |
| 0.18836 | 0.999 |
| 0.18837 | 0.999 |
| 0.18838 | 0.999 |
| 0.18839 | 0.999 |
| 0.1884 | 0.999 |
| 0.18841 | 0.999 |
| 0.18842 | 0.999 |
| 0.18843 | 0.999 |
| 0.18844 | 0.999 |
| 0.18845 | 0.999 |
| 0.18846 | 0.999 |
| 0.18847 | 0.999 |
| 0.18848 | 0.999 |
| 0.18849 | 0.999 |
| 0.1885 | 0.999 |
| 0.18851 | 0.999 |
| 0.18852 | 0.999 |
| 0.18853 | 0.999 |
| 0.18854 | 0.999 |
| 0.18855 | 0.999 |
| 0.18856 | 0.999 |
| 0.18857 | 0.999 |
| 0.18858 | 0.999 |
| 0.18859 | 0.999 |
| 0.1886 | 0.999 |
| 0.18861 | 0.999 |
| 0.18862 | 0.999 |
| 0.18863 | 0.999 |
| 0.18864 | 0.999 |
| 0.18865 | 0.999 |
| 0.18866 | 0.999 |
| 0.18867 | 0.999 |
| 0.18868 | 0.999 |
| 0.18869 | 0.999 |
| 0.1887 | 0.999 |
| 0.18871 | 0.999 |
| 0.18872 | 0.999 |
| 0.18873 | 0.999 |
| 0.18874 | 0.999 |
| 0.18875 | 0.999 |
| 0.18876 | 0.999 |
| 0.18877 | 0.999 |
| 0.18878 | 0.999 |
| 0.18879 | 0.999 |
| 0.1888 | 0.999 |
| 0.18881 | 0.999 |
| 0.18882 | 0.999 |
| 0.18883 | 0.999 |
| 0.18884 | 0.999 |
| 0.18885 | 0.999 |
| 0.18886 | 0.999 |
| 0.18887 | 0.999 |
| 0.18888 | 0.999 |
| 0.18889 | 0.999 |
| 0.1889 | 0.999 |
| 0.18891 | 0.999 |
| 0.18892 | 0.999 |
| 0.18893 | 0.999 |
| 0.18894 | 0.999 |
| 0.18895 | 0.999 |
| 0.18896 | 0.999 |
| 0.18897 | 0.999 |
| 0.18898 | 0.999 |
| 0.18899 | 0.999 |
| 0.189 | 0.999 |
| 0.18901 | 0.999 |
| 0.18902 | 0.999 |
| 0.18903 | 0.999 |
| 0.18904 | 0.999 |
| 0.18905 | 0.999 |
| 0.18906 | 0.999 |
| 0.18907 | 0.999 |
| 0.18908 | 0.999 |
| 0.18909 | 0.999 |
| 0.1891 | 0.999 |
| 0.18911 | 0.999 |
| 0.18912 | 0.999 |
| 0.18913 | 0.999 |
| 0.18914 | 0.999 |
| 0.18915 | 0.999 |
| 0.18916 | 0.999 |
| 0.18917 | 0.999 |
| 0.18918 | 0.999 |
| 0.18919 | 0.999 |
| 0.1892 | 0.999 |
| 0.18921 | 0.999 |
| 0.18922 | 0.999 |
| 0.18923 | 0.999 |
| 0.18924 | 0.999 |
| 0.18925 | 0.999 |
| 0.18926 | 0.999 |
| 0.18927 | 0.999 |
| 0.18928 | 0.999 |
| 0.18929 | 0.999 |
| 0.1893 | 0.999 |
| 0.18931 | 0.999 |
| 0.18932 | 0.999 |
| 0.18933 | 0.999 |
| 0.18934 | 0.999 |
| 0.18935 | 0.999 |
| 0.18936 | 0.999 |
| 0.18937 | 0.999 |
| 0.18938 | 0.999 |
| 0.18939 | 0.999 |
| 0.1894 | 0.999 |
| 0.18941 | 0.999 |
| 0.18942 | 0.999 |
| 0.18943 | 0.999 |
| 0.18944 | 0.999 |
| 0.18945 | 0.999 |
| 0.18946 | 0.999 |
| 0.18947 | 0.999 |
| 0.18948 | 0.999 |
| 0.18949 | 0.999 |
| 0.1895 | 0.999 |
| 0.18951 | 0.999 |
| 0.18952 | 0.999 |
| 0.18953 | 0.999 |
| 0.18954 | 0.999 |
| 0.18955 | 0.999 |
| 0.18956 | 0.999 |
| 0.18957 | 0.999 |
| 0.18958 | 0.999 |
| 0.18959 | 0.999 |
| 0.1896 | 0.999 |
| 0.18961 | 0.999 |
| 0.18962 | 0.999 |
| 0.18963 | 0.999 |
| 0.18964 | 0.999 |
| 0.18965 | 0.999 |
| 0.18966 | 0.999 |
| 0.18967 | 0.999 |
| 0.18968 | 0.999 |
| 0.18969 | 0.999 |
| 0.1897 | 0.999 |
| 0.18971 | 0.999 |
| 0.18972 | 0.999 |
| 0.18973 | 0.999 |
| 0.18974 | 0.999 |
| 0.18975 | 0.999 |
| 0.18976 | 0.999 |
| 0.18977 | 0.999 |
| 0.18978 | 0.999 |
| 0.18979 | 0.999 |
| 0.1898 | 0.999 |
| 0.18981 | 0.999 |
| 0.18982 | 1 |
| 0.18983 | 1 |
| 0.18984 | 1 |
| 0.18985 | 1 |
| 0.18986 | 1 |
| 0.18987 | 1 |
| 0.18988 | 1 |
| 0.18989 | 1 |
| 0.1899 | 1 |
| 0.18991 | 1 |
| 0.18992 | 1 |
| 0.18993 | 1 |
| 0.18994 | 1 |
| 0.18995 | 1 |
| 0.18996 | 1 |
| 0.18997 | 1 |
| 0.18998 | 1 |
| 0.18999 | 1 |
| 0.19 | 1 |
| 0.19001 | 1 |
| 0.19002 | 1 |
| 0.19003 | 1 |
| 0.19004 | 1 |
| 0.19005 | 1 |
| 0.19006 | 1 |
| 0.19007 | 1 |
| 0.19008 | 1 |
| 0.19009 | 1 |
| 0.1901 | 1 |
| 0.19011 | 1 |
| 0.19012 | 1 |
| 0.19013 | 1 |
| 0.19014 | 1 |
| 0.19015 | 1 |
| 0.19016 | 1 |
| 0.19017 | 1 |
| 0.19018 | 1 |
| 0.19019 | 1 |
| 0.1902 | 1 |
| 0.19021 | 1 |
| 0.19022 | 1 |
| 0.19023 | 1 |
| 0.19024 | 1 |
| 0.19025 | 1 |
| 0.19026 | 1 |
| 0.19027 | 1 |
| 0.19028 | 1 |
| 0.19029 | 1 |
| 0.1903 | 1 |
| 0.19031 | 1 |
| 0.19032 | 1 |
| 0.19033 | 1 |
| 0.19034 | 1 |
| 0.19035 | 1 |
| 0.19036 | 1 |
| 0.19037 | 1 |
| 0.19038 | 1 |
| 0.19039 | 1 |
| 0.1904 | 1 |
| 0.19041 | 1 |
| 0.19042 | 1 |
| 0.19043 | 1 |
| 0.19044 | 1 |
| 0.19045 | 1 |
| 0.19046 | 1 |
| 0.19047 | 1 |
| 0.19048 | 1 |
| 0.19049 | 1 |
| 0.1905 | 1 |
| 0.19051 | 1 |
| 0.19052 | 1 |
| 0.19053 | 1 |
| 0.19054 | 1 |
| 0.19055 | 1 |
| 0.19056 | 1 |
| 0.19057 | 1 |
| 0.19058 | 1 |
| 0.19059 | 1 |
| 0.1906 | 1 |
| 0.19061 | 1 |
| 0.19062 | 1 |
| 0.19063 | 1 |
| 0.19064 | 1 |
| 0.19065 | 1 |
| 0.19066 | 1 |
| 0.19067 | 1 |
| 0.19068 | 1 |
| 0.19069 | 1 |
| 0.1907 | 1 |
| 0.19071 | 1 |
| 0.19072 | 1 |
| 0.19073 | 1 |
| 0.19074 | 1 |
| 0.19075 | 1 |
| 0.19076 | 1 |
| 0.19077 | 1 |
| 0.19078 | 1 |
| 0.19079 | 1 |
| 0.1908 | 1 |
| 0.19081 | 1 |
| 0.19082 | 1 |
| 0.19083 | 1 |
| 0.19084 | 1 |
| 0.19085 | 1 |
| 0.19086 | 1 |
| 0.19087 | 1 |
| 0.19088 | 1 |
| 0.19089 | 1 |
| 0.1909 | 1 |
| 0.19091 | 1 |
| 0.19092 | 1 |
| 0.19093 | 1 |
| 0.19094 | 1 |
| 0.19095 | 1 |
| 0.19096 | 1 |
| 0.19097 | 1 |
| 0.19098 | 1 |
| 0.19099 | 1 |
| 0.191 | 1 |
| 0.19101 | 1 |
| 0.19102 | 1 |
| 0.19103 | 1 |
| 0.19104 | 1 |
| 0.19105 | 1 |
| 0.19106 | 1 |
| 0.19107 | 1 |
| 0.19108 | 1 |
| 0.19109 | 1 |
| 0.1911 | 1 |
| 0.19111 | 1 |
| 0.19112 | 1 |
| 0.19113 | 1 |
| 0.19114 | 1 |
| 0.19115 | 1 |
| 0.19116 | 1 |
| 0.19117 | 1 |
| 0.19118 | 1 |
| 0.19119 | 1 |
| 0.1912 | 1 |
| 0.19121 | 1 |
| 0.19122 | 1 |
| 0.19123 | 1 |
| 0.19124 | 1 |
| 0.19125 | 1 |
| 0.19126 | 1 |
| 0.19127 | 1 |
| 0.19128 | 1 |
| 0.19129 | 1 |
| 0.1913 | 1 |
| 0.19131 | 1 |
| 0.19132 | 1 |
| 0.19133 | 1 |
| 0.19134 | 1 |
| 0.19135 | 1 |
| 0.19136 | 1 |
| 0.19137 | 1 |
| 0.19138 | 1 |
| 0.19139 | 1 |
| 0.1914 | 1 |
| 0.19141 | 1 |
| 0.19142 | 1 |
| 0.19143 | 1 |
| 0.19144 | 1 |
| 0.19145 | 1 |
| 0.19146 | 1 |
| 0.19147 | 1 |
| 0.19148 | 1 |
| 0.19149 | 1 |
| 0.1915 | 1 |
| 0.19151 | 1 |
| 0.19152 | 1 |
| 0.19153 | 1 |
| 0.19154 | 1 |
| 0.19155 | 1 |
| 0.19156 | 1 |
| 0.19157 | 1 |
| 0.19158 | 1 |
| 0.19159 | 1 |
| 0.1916 | 1 |
| 0.19161 | 1 |
| 0.19162 | 1 |
| 0.19163 | 1 |
| 0.19164 | 1 |
| 0.19165 | 1 |
| 0.19166 | 1 |
| 0.19167 | 1 |
| 0.19168 | 1 |
| 0.19169 | 1 |
| 0.1917 | 1 |
| 0.19171 | 1 |
| 0.19172 | 1 |
| 0.19173 | 1 |
| 0.19174 | 1 |
| 0.19175 | 1 |
| 0.19176 | 1 |
| 0.19177 | 1 |
| 0.19178 | 1 |
| 0.19179 | 1 |
| 0.1918 | 1 |
| 0.19181 | 1 |
| 0.19182 | 1 |
| 0.19183 | 1 |
| 0.19184 | 1 |
| 0.19185 | 1 |
| 0.19186 | 1 |
| 0.19187 | 1 |
| 0.19188 | 1 |
| 0.19189 | 1 |
| 0.1919 | 1 |
| 0.19191 | 1 |
| 0.19192 | 1 |
| 0.19193 | 1 |
| 0.19194 | 1 |
| 0.19195 | 1 |
| 0.19196 | 1 |
| 0.19197 | 1 |
| 0.19198 | 1 |
| 0.19199 | 1 |
| 0.192 | 1 |
| 0.19201 | 1 |
| 0.19202 | 1 |
| 0.19203 | 1 |
| 0.19204 | 1 |
| 0.19205 | 1 |
| 0.19206 | 1 |
| 0.19207 | 1 |
| 0.19208 | 1 |
| 0.19209 | 1 |
| 0.1921 | 1 |
| 0.19211 | 1 |
| 0.19212 | 1 |
| 0.19213 | 1 |
| 0.19214 | 1 |
| 0.19215 | 1 |
| 0.19216 | 1 |
| 0.19217 | 1 |
| 0.19218 | 1 |
| 0.19219 | 1 |
| 0.1922 | 1 |
| 0.19221 | 1 |
| 0.19222 | 1 |
| 0.19223 | 1 |
| 0.19224 | 1 |
| 0.19225 | 1 |
| 0.19226 | 1 |
| 0.19227 | 1 |
| 0.19228 | 1 |
| 0.19229 | 1 |
| 0.1923 | 1 |
| 0.19231 | 1 |
| 0.19232 | 1 |
| 0.19233 | 1 |
| 0.19234 | 1 |
| 0.19235 | 1 |
| 0.19236 | 1 |
| 0.19237 | 1 |
| 0.19238 | 1 |
| 0.19239 | 1 |
| 0.1924 | 1 |
| 0.19241 | 1 |
| 0.19242 | 1 |
| 0.19243 | 1 |
| 0.19244 | 1 |
| 0.19245 | 1 |
| 0.19246 | 1 |
| 0.19247 | 1 |
| 0.19248 | 1 |
| 0.19249 | 1 |
| 0.1925 | 1 |
| 0.19251 | 1 |
| 0.19252 | 1 |
| 0.19253 | 1 |
| 0.19254 | 1 |
| 0.19255 | 1 |
| 0.19256 | 1 |
| 0.19257 | 1 |
| 0.19258 | 1 |
| 0.19259 | 1 |
| 0.1926 | 1 |
| 0.19261 | 1 |
| 0.19262 | 1 |
| 0.19263 | 1 |
| 0.19264 | 1 |
| 0.19265 | 1 |
| 0.19266 | 1 |
| 0.19267 | 1 |
| 0.19268 | 1 |
| 0.19269 | 1 |
| 0.1927 | 1 |
| 0.19271 | 1 |
| 0.19272 | 1 |
| 0.19273 | 1 |
| 0.19274 | 1 |
| 0.19275 | 1 |
| 0.19276 | 1 |
| 0.19277 | 1 |
| 0.19278 | 1 |
| 0.19279 | 1 |
| 0.1928 | 1 |
| 0.19281 | 1 |
| 0.19282 | 1 |
| 0.19283 | 1 |
| 0.19284 | 1 |
| 0.19285 | 1 |
| 0.19286 | 1 |
| 0.19287 | 1 |
| 0.19288 | 1 |
| 0.19289 | 1 |
| 0.1929 | 1 |
| 0.19291 | 1 |
| 0.19292 | 1 |
| 0.19293 | 1 |
| 0.19294 | 1 |
| 0.19295 | 1 |
| 0.19296 | 1 |
| 0.19297 | 1 |
| 0.19298 | 1 |
| 0.19299 | 1 |
| 0.193 | 1 |
| 0.19301 | 1 |
| 0.19302 | 1 |
| 0.19303 | 1 |
| 0.19304 | 1 |
| 0.19305 | 1 |
| 0.19306 | 1 |
| 0.19307 | 1 |
| 0.19308 | 1 |
| 0.19309 | 1 |
| 0.1931 | 1 |
| 0.19311 | 1 |
| 0.19312 | 1 |
| 0.19313 | 1 |
| 0.19314 | 1 |
| 0.19315 | 1 |
| 0.19316 | 1 |
| 0.19317 | 1 |
| 0.19318 | 1 |
| 0.19319 | 1 |
| 0.1932 | 1 |
| 0.19321 | 1 |
| 0.19322 | 1 |
| 0.19323 | 1 |
| 0.19324 | 1 |
| 0.19325 | 1 |
| 0.19326 | 1 |
| 0.19327 | 1 |
| 0.19328 | 1 |
| 0.19329 | 1 |
| 0.1933 | 1 |
| 0.19331 | 1 |
| 0.19332 | 1 |
| 0.19333 | 1 |
| 0.19334 | 1 |
| 0.19335 | 1 |
| 0.19336 | 1 |
| 0.19337 | 1 |
| 0.19338 | 1 |
| 0.19339 | 1 |
| 0.1934 | 1 |
| 0.19341 | 1 |
| 0.19342 | 1 |
| 0.19343 | 1 |
| 0.19344 | 1 |
| 0.19345 | 1 |
| 0.19346 | 1 |
| 0.19347 | 1 |
| 0.19348 | 1 |
| 0.19349 | 1 |
| 0.1935 | 1 |
| 0.19351 | 1 |
| 0.19352 | 1 |
| 0.19353 | 1 |
| 0.19354 | 1 |
| 0.19355 | 1 |
| 0.19356 | 1 |
| 0.19357 | 1 |
| 0.19358 | 1 |
| 0.19359 | 1 |
| 0.1936 | 1 |
| 0.19361 | 1 |
| 0.19362 | 1 |
| 0.19363 | 1 |
| 0.19364 | 1 |
| 0.19365 | 1 |
| 0.19366 | 1 |
| 0.19367 | 1 |
| 0.19368 | 1 |
| 0.19369 | 1 |
| 0.1937 | 1 |
| 0.19371 | 1 |
| 0.19372 | 1 |
| 0.19373 | 1 |
| 0.19374 | 1 |
| 0.19375 | 1 |
| 0.19376 | 1 |
| 0.19377 | 1 |
| 0.19378 | 1 |
| 0.19379 | 1 |
| 0.1938 | 1 |
| 0.19381 | 1 |
| 0.19382 | 1 |
| 0.19383 | 1 |
| 0.19384 | 1 |
| 0.19385 | 1 |
| 0.19386 | 1 |
| 0.19387 | 1 |
| 0.19388 | 1 |
| 0.19389 | 1 |
| 0.1939 | 1 |
| 0.19391 | 1 |
| 0.19392 | 1 |
| 0.19393 | 1 |
| 0.19394 | 1 |
| 0.19395 | 1 |
| 0.19396 | 1 |
| 0.19397 | 1 |
| 0.19398 | 1 |
| 0.19399 | 1 |
| 0.194 | 1 |
| 0.19401 | 1 |
| 0.19402 | 1 |
| 0.19403 | 1 |
| 0.19404 | 1 |
| 0.19405 | 1 |
| 0.19406 | 1 |
| 0.19407 | 1 |
| 0.19408 | 1 |
| 0.19409 | 1 |
| 0.1941 | 1 |
| 0.19411 | 1 |
| 0.19412 | 1 |
| 0.19413 | 1 |
| 0.19414 | 1 |
| 0.19415 | 1 |
| 0.19416 | 1 |
| 0.19417 | 1 |
| 0.19418 | 1 |
| 0.19419 | 1 |
| 0.1942 | 1 |
| 0.19421 | 1 |
| 0.19422 | 1 |
| 0.19423 | 1 |
| 0.19424 | 1 |
| 0.19425 | 1 |
| 0.19426 | 1 |
| 0.19427 | 1 |
| 0.19428 | 1 |
| 0.19429 | 1 |
| 0.1943 | 1 |
| 0.19431 | 1 |
| 0.19432 | 1 |
| 0.19433 | 1 |
| 0.19434 | 1 |
| 0.19435 | 1 |
| 0.19436 | 1 |
| 0.19437 | 1 |
| 0.19438 | 1 |
| 0.19439 | 1 |
| 0.1944 | 1 |
| 0.19441 | 1 |
| 0.19442 | 1 |
| 0.19443 | 1 |
| 0.19444 | 1 |
| 0.19445 | 1 |
| 0.19446 | 1 |
| 0.19447 | 1 |
| 0.19448 | 1 |
| 0.19449 | 1 |
| 0.1945 | 1 |
| 0.19451 | 1 |
| 0.19452 | 1 |
| 0.19453 | 1 |
| 0.19454 | 1 |
| 0.19455 | 1 |
| 0.19456 | 1 |
| 0.19457 | 1 |
| 0.19458 | 1 |
| 0.19459 | 1 |
| 0.1946 | 1 |
| 0.19461 | 1 |
| 0.19462 | 1 |
| 0.19463 | 1 |
| 0.19464 | 1 |
| 0.19465 | 1 |
| 0.19466 | 1 |
| 0.19467 | 1 |
| 0.19468 | 1 |
| 0.19469 | 1 |
| 0.1947 | 1 |
| 0.19471 | 1 |
| 0.19472 | 1 |
| 0.19473 | 1 |
| 0.19474 | 1 |
| 0.19475 | 1 |
| 0.19476 | 1 |
| 0.19477 | 1 |
| 0.19478 | 1 |
| 0.19479 | 1 |
| 0.1948 | 1 |
| 0.19481 | 1 |
| 0.19482 | 1 |
| 0.19483 | 1 |
| 0.19484 | 1 |
| 0.19485 | 1 |
| 0.19486 | 1 |
| 0.19487 | 1 |
| 0.19488 | 1 |
| 0.19489 | 1 |
| 0.1949 | 1 |
| 0.19491 | 1 |
| 0.19492 | 1 |
| 0.19493 | 1 |
| 0.19494 | 1 |
| 0.19495 | 1 |
| 0.19496 | 1 |
| 0.19497 | 1 |
| 0.19498 | 1 |
| 0.19499 | 1 |
| 0.195 | 1 |
| 0.19501 | 1 |
| 0.19502 | 1 |
| 0.19503 | 1 |
| 0.19504 | 1 |
| 0.19505 | 1 |
| 0.19506 | 1 |
| 0.19507 | 1 |
| 0.19508 | 1 |
| 0.19509 | 1 |
| 0.1951 | 1 |
| 0.19511 | 1 |
| 0.19512 | 1 |
| 0.19513 | 1 |
| 0.19514 | 1 |
| 0.19515 | 1 |
| 0.19516 | 1 |
| 0.19517 | 1 |
| 0.19518 | 1 |
| 0.19519 | 1 |
| 0.1952 | 1 |
| 0.19521 | 1 |
| 0.19522 | 1 |
| 0.19523 | 1 |
| 0.19524 | 1 |
| 0.19525 | 1 |
| 0.19526 | 1 |
| 0.19527 | 1 |
| 0.19528 | 1 |
| 0.19529 | 1 |
| 0.1953 | 1 |
| 0.19531 | 1 |
| 0.19532 | 1 |
| 0.19533 | 1 |
| 0.19534 | 1 |
| 0.19535 | 1 |
| 0.19536 | 1 |
| 0.19537 | 1 |
| 0.19538 | 1 |
| 0.19539 | 1 |
| 0.1954 | 1 |
| 0.19541 | 1 |
| 0.19542 | 1 |
| 0.19543 | 1 |
| 0.19544 | 1 |
| 0.19545 | 1 |
| 0.19546 | 1 |
| 0.19547 | 1 |
| 0.19548 | 1 |
| 0.19549 | 1 |
| 0.1955 | 1 |
| 0.19551 | 1 |
| 0.19552 | 1 |
| 0.19553 | 1 |
| 0.19554 | 1 |
| 0.19555 | 1 |
| 0.19556 | 1 |
| 0.19557 | 1 |
| 0.19558 | 1 |
| 0.19559 | 1 |
| 0.1956 | 1 |
| 0.19561 | 1 |
| 0.19562 | 1 |
| 0.19563 | 1 |
| 0.19564 | 1 |
| 0.19565 | 1 |
| 0.19566 | 1 |
| 0.19567 | 1 |
| 0.19568 | 1 |
| 0.19569 | 1 |
| 0.1957 | 1 |
| 0.19571 | 1 |
| 0.19572 | 1 |
| 0.19573 | 1 |
| 0.19574 | 1 |
| 0.19575 | 1 |
| 0.19576 | 1 |
| 0.19577 | 1 |
| 0.19578 | 1 |
| 0.19579 | 1 |
| 0.1958 | 1 |
| 0.19581 | 1 |
| 0.19582 | 1 |
| 0.19583 | 1 |
| 0.19584 | 1 |
| 0.19585 | 1 |
| 0.19586 | 1 |
| 0.19587 | 1 |
| 0.19588 | 1 |
| 0.19589 | 1 |
| 0.1959 | 1 |
| 0.19591 | 1 |
| 0.19592 | 1 |
| 0.19593 | 1 |
| 0.19594 | 1 |
| 0.19595 | 1 |
| 0.19596 | 1 |
| 0.19597 | 1 |
| 0.19598 | 1 |
| 0.19599 | 1 |
| 0.196 | 1 |
| 0.19601 | 1 |
| 0.19602 | 1 |
| 0.19603 | 1 |
| 0.19604 | 1 |
| 0.19605 | 1 |
| 0.19606 | 1 |
| 0.19607 | 1 |
| 0.19608 | 1 |
| 0.19609 | 1 |
| 0.1961 | 1 |
| 0.19611 | 1 |
| 0.19612 | 1 |
| 0.19613 | 1 |
| 0.19614 | 1 |
| 0.19615 | 1 |
| 0.19616 | 1 |
| 0.19617 | 1 |
| 0.19618 | 1 |
| 0.19619 | 1 |
| 0.1962 | 1 |
| 0.19621 | 1 |
| 0.19622 | 1 |
| 0.19623 | 1 |
| 0.19624 | 1 |
| 0.19625 | 1 |
| 0.19626 | 1 |
| 0.19627 | 1 |
| 0.19628 | 1 |
| 0.19629 | 1 |
| 0.1963 | 1 |
| 0.19631 | 1 |
| 0.19632 | 1 |
| 0.19633 | 1 |
| 0.19634 | 1 |
| 0.19635 | 1 |
| 0.19636 | 1 |
| 0.19637 | 1 |
| 0.19638 | 1 |
| 0.19639 | 1 |
| 0.1964 | 1 |
| 0.19641 | 1 |
| 0.19642 | 1 |
| 0.19643 | 1 |
| 0.19644 | 1 |
| 0.19645 | 1 |
| 0.19646 | 1 |
| 0.19647 | 1 |
| 0.19648 | 1 |
| 0.19649 | 1 |
| 0.1965 | 1 |
| 0.19651 | 1 |
| 0.19652 | 1 |
| 0.19653 | 1 |
| 0.19654 | 1 |
| 0.19655 | 1 |
| 0.19656 | 1 |
| 0.19657 | 1 |
| 0.19658 | 1 |
| 0.19659 | 1 |
| 0.1966 | 1 |
| 0.19661 | 1 |
| 0.19662 | 1 |
| 0.19663 | 1 |
| 0.19664 | 1 |
| 0.19665 | 1 |
| 0.19666 | 1 |
| 0.19667 | 1 |
| 0.19668 | 1 |
| 0.19669 | 1 |
| 0.1967 | 1 |
| 0.19671 | 1 |
| 0.19672 | 1 |
| 0.19673 | 1 |
| 0.19674 | 1 |
| 0.19675 | 1 |
| 0.19676 | 1 |
| 0.19677 | 1 |
| 0.19678 | 1 |
| 0.19679 | 1 |
| 0.1968 | 1 |
| 0.19681 | 1 |
| 0.19682 | 1 |
| 0.19683 | 1 |
| 0.19684 | 1 |
| 0.19685 | 1 |
| 0.19686 | 1 |
| 0.19687 | 1 |
| 0.19688 | 1 |
| 0.19689 | 1 |
| 0.1969 | 1 |
| 0.19691 | 1 |
| 0.19692 | 1 |
| 0.19693 | 1 |
| 0.19694 | 1 |
| 0.19695 | 1 |
| 0.19696 | 1 |
| 0.19697 | 1 |
| 0.19698 | 1 |
| 0.19699 | 1 |
| 0.197 | 1 |
| 0.19701 | 1 |
| 0.19702 | 1 |
| 0.19703 | 1 |
| 0.19704 | 1 |
| 0.19705 | 1 |
| 0.19706 | 1 |
| 0.19707 | 1 |
| 0.19708 | 1 |
| 0.19709 | 1 |
| 0.1971 | 1 |
| 0.19711 | 1 |
| 0.19712 | 1 |
| 0.19713 | 1 |
| 0.19714 | 1 |
| 0.19715 | 1 |
| 0.19716 | 1 |
| 0.19717 | 1 |
| 0.19718 | 1 |
| 0.19719 | 1 |
| 0.1972 | 1 |
| 0.19721 | 1 |
| 0.19722 | 1 |
| 0.19723 | 1 |
| 0.19724 | 1 |
| 0.19725 | 1 |
| 0.19726 | 1 |
| 0.19727 | 1 |
| 0.19728 | 1 |
| 0.19729 | 1 |
| 0.1973 | 1 |
| 0.19731 | 1 |
| 0.19732 | 1 |
| 0.19733 | 1 |
| 0.19734 | 1 |
| 0.19735 | 1 |
| 0.19736 | 1 |
| 0.19737 | 1 |
| 0.19738 | 1 |
| 0.19739 | 1 |
| 0.1974 | 1 |
| 0.19741 | 1 |
| 0.19742 | 1 |
| 0.19743 | 1 |
| 0.19744 | 1 |
| 0.19745 | 1 |
| 0.19746 | 1 |
| 0.19747 | 1 |
| 0.19748 | 1 |
| 0.19749 | 1 |
| 0.1975 | 1 |
| 0.19751 | 1 |
| 0.19752 | 1 |
| 0.19753 | 1 |
| 0.19754 | 1 |
| 0.19755 | 1 |
| 0.19756 | 1 |
| 0.19757 | 1 |
| 0.19758 | 1 |
| 0.19759 | 1 |
| 0.1976 | 1 |
| 0.19761 | 1 |
| 0.19762 | 1 |
| 0.19763 | 1 |
| 0.19764 | 1 |
| 0.19765 | 1 |
| 0.19766 | 1 |
| 0.19767 | 1 |
| 0.19768 | 1 |
| 0.19769 | 1 |
| 0.1977 | 1 |
| 0.19771 | 1 |
| 0.19772 | 1 |
| 0.19773 | 1 |
| 0.19774 | 1 |
| 0.19775 | 1 |
| 0.19776 | 1 |
| 0.19777 | 1 |
| 0.19778 | 1 |
| 0.19779 | 1 |
| 0.1978 | 1 |
| 0.19781 | 1 |
| 0.19782 | 1 |
| 0.19783 | 1 |
| 0.19784 | 1 |
| 0.19785 | 1 |
| 0.19786 | 1 |
| 0.19787 | 1 |
| 0.19788 | 1 |
| 0.19789 | 1 |
| 0.1979 | 1 |
| 0.19791 | 1 |
| 0.19792 | 1 |
| 0.19793 | 1 |
| 0.19794 | 1 |
| 0.19795 | 1 |
| 0.19796 | 1 |
| 0.19797 | 1 |
| 0.19798 | 1 |
| 0.19799 | 1 |
| 0.198 | 1 |
| 0.19801 | 1 |
| 0.19802 | 1 |
| 0.19803 | 1 |
| 0.19804 | 1 |
| 0.19805 | 1 |
| 0.19806 | 1 |
| 0.19807 | 1 |
| 0.19808 | 1 |
| 0.19809 | 1 |
| 0.1981 | 1 |
| 0.19811 | 1 |
| 0.19812 | 1 |
| 0.19813 | 1 |
| 0.19814 | 1 |
| 0.19815 | 1 |
| 0.19816 | 1 |
| 0.19817 | 1 |
| 0.19818 | 1 |
| 0.19819 | 1 |
| 0.1982 | 1 |
| 0.19821 | 1 |
| 0.19822 | 1 |
| 0.19823 | 1 |
| 0.19824 | 1 |
| 0.19825 | 1 |
| 0.19826 | 1 |
| 0.19827 | 1 |
| 0.19828 | 1 |
| 0.19829 | 1 |
| 0.1983 | 1 |
| 0.19831 | 1 |
| 0.19832 | 1 |
| 0.19833 | 1 |
| 0.19834 | 1 |
| 0.19835 | 1 |
| 0.19836 | 1 |
| 0.19837 | 1 |
| 0.19838 | 1 |
| 0.19839 | 1 |
| 0.1984 | 1 |
| 0.19841 | 1 |
| 0.19842 | 1 |
| 0.19843 | 1 |
| 0.19844 | 1 |
| 0.19845 | 1 |
| 0.19846 | 1 |
| 0.19847 | 1 |
| 0.19848 | 1 |
| 0.19849 | 1 |
| 0.1985 | 1 |
| 0.19851 | 1 |
| 0.19852 | 1 |
| 0.19853 | 1 |
| 0.19854 | 1 |
| 0.19855 | 1 |
| 0.19856 | 1 |
| 0.19857 | 1 |
| 0.19858 | 1 |
| 0.19859 | 1 |
| 0.1986 | 1 |
| 0.19861 | 1 |
| 0.19862 | 1 |
| 0.19863 | 1 |
| 0.19864 | 1 |
| 0.19865 | 1 |
| 0.19866 | 1 |
| 0.19867 | 1 |
| 0.19868 | 1 |
| 0.19869 | 1 |
| 0.1987 | 1 |
| 0.19871 | 1 |
| 0.19872 | 1 |
| 0.19873 | 1 |
| 0.19874 | 1 |
| 0.19875 | 1 |
| 0.19876 | 1 |
| 0.19877 | 1 |
| 0.19878 | 1 |
| 0.19879 | 1 |
| 0.1988 | 1 |
| 0.19881 | 1 |
| 0.19882 | 1 |
| 0.19883 | 1 |
| 0.19884 | 1 |
| 0.19885 | 1 |
| 0.19886 | 1 |
| 0.19887 | 1 |
| 0.19888 | 1 |
| 0.19889 | 1 |
| 0.1989 | 1 |
| 0.19891 | 1 |
| 0.19892 | 1 |
| 0.19893 | 1 |
| 0.19894 | 1 |
| 0.19895 | 1 |
| 0.19896 | 1 |
| 0.19897 | 1 |
| 0.19898 | 1 |
| 0.19899 | 1 |
| 0.199 | 1 |
| 0.19901 | 1 |
| 0.19902 | 1 |
| 0.19903 | 1 |
| 0.19904 | 1 |
| 0.19905 | 1 |
| 0.19906 | 1 |
| 0.19907 | 1 |
| 0.19908 | 1 |
| 0.19909 | 1 |
| 0.1991 | 1 |
| 0.19911 | 1 |
| 0.19912 | 1 |
| 0.19913 | 1 |
| 0.19914 | 1 |
| 0.19915 | 1 |
| 0.19916 | 1 |
| 0.19917 | 1 |
| 0.19918 | 1 |
| 0.19919 | 1 |
| 0.1992 | 1 |
| 0.19921 | 1 |
| 0.19922 | 1 |
| 0.19923 | 1 |
| 0.19924 | 1 |
| 0.19925 | 1 |
| 0.19926 | 1 |
| 0.19927 | 1 |
| 0.19928 | 1 |
| 0.19929 | 1 |
| 0.1993 | 1 |
| 0.19931 | 1 |
| 0.19932 | 1 |
| 0.19933 | 1 |
| 0.19934 | 1 |
| 0.19935 | 1 |
| 0.19936 | 1 |
| 0.19937 | 1 |
| 0.19938 | 1 |
| 0.19939 | 1 |
| 0.1994 | 1 |
| 0.19941 | 1 |
| 0.19942 | 1 |
| 0.19943 | 1 |
| 0.19944 | 1 |
| 0.19945 | 1 |
| 0.19946 | 1 |
| 0.19947 | 1 |
| 0.19948 | 1 |
| 0.19949 | 1 |
| 0.1995 | 1 |
| 0.19951 | 1 |
| 0.19952 | 1 |
| 0.19953 | 1 |
| 0.19954 | 1 |
| 0.19955 | 1 |
| 0.19956 | 1 |
| 0.19957 | 1 |
| 0.19958 | 1 |
| 0.19959 | 1 |
| 0.1996 | 1 |
| 0.19961 | 1 |
| 0.19962 | 1 |
| 0.19963 | 1 |
| 0.19964 | 1 |
| 0.19965 | 1 |
| 0.19966 | 1 |
| 0.19967 | 1 |
| 0.19968 | 1 |
| 0.19969 | 1 |
| 0.1997 | 1 |
| 0.19971 | 1 |
| 0.19972 | 1 |
| 0.19973 | 1 |
| 0.19974 | 1 |
| 0.19975 | 1 |
| 0.19976 | 1 |
| 0.19977 | 1 |
| 0.19978 | 1 |
| 0.19979 | 1 |
| 0.1998 | 1 |
| 0.19981 | 1 |
| 0.19982 | 1 |
| 0.19983 | 1 |
| 0.19984 | 1 |
| 0.19985 | 1 |
| 0.19986 | 1 |
| 0.19987 | 1 |
| 0.19988 | 1 |
| 0.19989 | 1 |
| 0.1999 | 1 |
| 0.19991 | 1 |
| 0.19992 | 1 |
| 0.19993 | 1 |
| 0.19994 | 1 |
| 0.19995 | 1 |
| 0.19996 | 1 |
| 0.19997 | 1 |
| 0.19998 | 1 |
| 0.19999 | 1 |
| 0.2 | 1 |
| 0.20001 | 1 |
| 0.20002 | 1 |
| 0.20003 | 1 |
| 0.20004 | 1 |
| 0.20005 | 1 |
| 0.20006 | 1 |
| 0.20007 | 1 |
| 0.20008 | 1 |
| 0.20009 | 1 |
| 0.2001 | 1 |
| 0.20011 | 1 |
| 0.20012 | 1 |
| 0.20013 | 1 |
| 0.20014 | 1 |
| 0.20015 | 1 |
| 0.20016 | 1 |
| 0.20017 | 1 |
| 0.20018 | 1 |
| 0.20019 | 1 |
| 0.2002 | 1 |
| 0.20021 | 1 |
| 0.20022 | 1 |
| 0.20023 | 1 |
| 0.20024 | 1 |
| 0.20025 | 1 |
| 0.20026 | 1 |
| 0.20027 | 1 |
| 0.20028 | 1 |
| 0.20029 | 1 |
| 0.2003 | 1 |
| 0.20031 | 1 |
| 0.20032 | 1 |
| 0.20033 | 1 |
| 0.20034 | 1 |
| 0.20035 | 1 |
| 0.20036 | 1 |
| 0.20037 | 1 |
| 0.20038 | 1 |
| 0.20039 | 1 |
| 0.2004 | 1 |
| 0.20041 | 1 |
| 0.20042 | 1 |
| 0.20043 | 1 |
| 0.20044 | 1 |
| 0.20045 | 1 |
| 0.20046 | 1 |
| 0.20047 | 1 |
| 0.20048 | 1 |
| 0.20049 | 1 |
| 0.2005 | 1 |
| 0.20051 | 1 |
| 0.20052 | 1 |
| 0.20053 | 1 |
| 0.20054 | 1 |
| 0.20055 | 1 |
| 0.20056 | 1 |
| 0.20057 | 1 |
| 0.20058 | 1 |
| 0.20059 | 1 |
| 0.2006 | 1 |
| 0.20061 | 1 |
| 0.20062 | 1 |
| 0.20063 | 1 |
| 0.20064 | 1 |
| 0.20065 | 1 |
| 0.20066 | 1 |
| 0.20067 | 1 |
| 0.20068 | 1 |
| 0.20069 | 1 |
| 0.2007 | 1 |
| 0.20071 | 1 |
| 0.20072 | 1 |
| 0.20073 | 1 |
| 0.20074 | 1 |
| 0.20075 | 1 |
| 0.20076 | 1 |
| 0.20077 | 1 |
| 0.20078 | 1 |
| 0.20079 | 1 |
| 0.2008 | 1 |
| 0.20081 | 1 |
| 0.20082 | 1 |
| 0.20083 | 1 |
| 0.20084 | 1 |
| 0.20085 | 1 |
| 0.20086 | 1 |
| 0.20087 | 1 |
| 0.20088 | 1 |
| 0.20089 | 1 |
| 0.2009 | 1 |
| 0.20091 | 1 |
| 0.20092 | 1 |
| 0.20093 | 1 |
| 0.20094 | 1 |
| 0.20095 | 1 |
| 0.20096 | 1 |
| 0.20097 | 1 |
| 0.20098 | 1 |
| 0.20099 | 1 |
| 0.201 | 1 |
| 0.20101 | 1 |
| 0.20102 | 1 |
| 0.20103 | 1 |
| 0.20104 | 1 |
| 0.20105 | 1 |
| 0.20106 | 1 |
| 0.20107 | 1 |
| 0.20108 | 1 |
| 0.20109 | 1 |
| 0.2011 | 1 |
| 0.20111 | 1 |
| 0.20112 | 1 |
| 0.20113 | 1 |
| 0.20114 | 1 |
| 0.20115 | 1 |
| 0.20116 | 1 |
| 0.20117 | 1 |
| 0.20118 | 1 |
| 0.20119 | 1 |
| 0.2012 | 1 |
| 0.20121 | 1 |
| 0.20122 | 1 |
| 0.20123 | 1 |
| 0.20124 | 1 |
| 0.20125 | 1 |
| 0.20126 | 1 |
| 0.20127 | 1 |
| 0.20128 | 1 |
| 0.20129 | 1 |
| 0.2013 | 1 |
| 0.20131 | 1 |
| 0.20132 | 1 |
| 0.20133 | 1 |
| 0.20134 | 1 |
| 0.20135 | 1 |
| 0.20136 | 1 |
| 0.20137 | 1 |
| 0.20138 | 1 |
| 0.20139 | 1 |
| 0.2014 | 1 |
| 0.20141 | 1 |
| 0.20142 | 1 |
| 0.20143 | 1 |
| 0.20144 | 1 |
| 0.20145 | 1 |
| 0.20146 | 1 |
| 0.20147 | 1 |
| 0.20148 | 1 |
| 0.20149 | 1 |
| 0.2015 | 1 |
| 0.20151 | 1 |
| 0.20152 | 1 |
| 0.20153 | 1 |
| 0.20154 | 1 |
| 0.20155 | 1 |
| 0.20156 | 1 |
| 0.20157 | 1 |
| 0.20158 | 1 |
| 0.20159 | 1 |
| 0.2016 | 1 |
| 0.20161 | 1 |
| 0.20162 | 1 |
| 0.20163 | 1 |
| 0.20164 | 1 |
| 0.20165 | 1 |
| 0.20166 | 1 |
| 0.20167 | 1 |
| 0.20168 | 1 |
| 0.20169 | 1 |
| 0.2017 | 1 |
| 0.20171 | 1 |
| 0.20172 | 1 |
| 0.20173 | 1 |
| 0.20174 | 1 |
| 0.20175 | 1 |
| 0.20176 | 1 |
| 0.20177 | 1 |
| 0.20178 | 1 |
| 0.20179 | 1 |
| 0.2018 | 1 |
| 0.20181 | 1 |
| 0.20182 | 1 |
| 0.20183 | 1 |
| 0.20184 | 1 |
| 0.20185 | 1 |
| 0.20186 | 1 |
| 0.20187 | 1 |
| 0.20188 | 1 |
| 0.20189 | 1 |
| 0.2019 | 1 |
| 0.20191 | 1 |
| 0.20192 | 1 |
| 0.20193 | 1 |
| 0.20194 | 1 |
| 0.20195 | 1 |
| 0.20196 | 1 |
| 0.20197 | 1 |
| 0.20198 | 1 |
| 0.20199 | 1 |
| 0.202 | 1 |
| 0.20201 | 1 |
| 0.20202 | 1 |
| 0.20203 | 1 |
| 0.20204 | 1 |
| 0.20205 | 1 |
| 0.20206 | 1 |
| 0.20207 | 1 |
| 0.20208 | 1 |
| 0.20209 | 1 |
| 0.2021 | 1 |
| 0.20211 | 1 |
| 0.20212 | 1 |
| 0.20213 | 1 |
| 0.20214 | 1 |
| 0.20215 | 1 |
| 0.20216 | 1 |
| 0.20217 | 1 |
| 0.20218 | 1 |
| 0.20219 | 1 |
| 0.2022 | 1 |
| 0.20221 | 1 |
| 0.20222 | 1 |
| 0.20223 | 1 |
| 0.20224 | 1 |
| 0.20225 | 1 |
| 0.20226 | 1 |
| 0.20227 | 1 |
| 0.20228 | 1 |
| 0.20229 | 1 |
| 0.2023 | 1 |
| 0.20231 | 1 |
| 0.20232 | 1 |
| 0.20233 | 1 |
| 0.20234 | 1 |
| 0.20235 | 1 |
| 0.20236 | 1 |
| 0.20237 | 1 |
| 0.20238 | 1 |
| 0.20239 | 1 |
| 0.2024 | 1 |
| 0.20241 | 1 |
| 0.20242 | 1 |
| 0.20243 | 1 |
| 0.20244 | 1 |
| 0.20245 | 1 |
| 0.20246 | 1 |
| 0.20247 | 1 |
| 0.20248 | 1 |
| 0.20249 | 1 |
| 0.2025 | 1 |
| 0.20251 | 1 |
| 0.20252 | 1 |
| 0.20253 | 1 |
| 0.20254 | 1 |
| 0.20255 | 1 |
| 0.20256 | 1 |
| 0.20257 | 1 |
| 0.20258 | 1 |
| 0.20259 | 1 |
| 0.2026 | 1 |
| 0.20261 | 1 |
| 0.20262 | 1 |
| 0.20263 | 1 |
| 0.20264 | 1 |
| 0.20265 | 1 |
| 0.20266 | 1 |
| 0.20267 | 1 |
| 0.20268 | 1 |
| 0.20269 | 1 |
| 0.2027 | 1 |
| 0.20271 | 1 |
| 0.20272 | 1 |
| 0.20273 | 1 |
| 0.20274 | 1 |
| 0.20275 | 1 |
| 0.20276 | 1 |
| 0.20277 | 1 |
| 0.20278 | 1 |
| 0.20279 | 1 |
| 0.2028 | 1 |
| 0.20281 | 1 |
| 0.20282 | 1 |
| 0.20283 | 1 |
| 0.20284 | 1 |
| 0.20285 | 1 |
| 0.20286 | 1 |
| 0.20287 | 1 |
| 0.20288 | 1 |
| 0.20289 | 1 |
| 0.2029 | 1 |
| 0.20291 | 1 |
| 0.20292 | 1 |
| 0.20293 | 1 |
| 0.20294 | 1 |
| 0.20295 | 1 |
| 0.20296 | 1 |
| 0.20297 | 1 |
| 0.20298 | 1 |
| 0.20299 | 1 |
| 0.203 | 1 |
| 0.20301 | 1 |
| 0.20302 | 1 |
| 0.20303 | 1 |
| 0.20304 | 1 |
| 0.20305 | 1 |
| 0.20306 | 1 |
| 0.20307 | 1 |
| 0.20308 | 1 |
| 0.20309 | 1 |
| 0.2031 | 1 |
| 0.20311 | 1 |
| 0.20312 | 1 |
| 0.20313 | 1 |
| 0.20314 | 1 |
| 0.20315 | 1 |
| 0.20316 | 1 |
| 0.20317 | 1 |
| 0.20318 | 1 |
| 0.20319 | 1 |
| 0.2032 | 1 |
| 0.20321 | 1 |
| 0.20322 | 1 |
| 0.20323 | 1 |
| 0.20324 | 1 |
| 0.20325 | 1 |
| 0.20326 | 1 |
| 0.20327 | 1 |
| 0.20328 | 1 |
| 0.20329 | 1 |
| 0.2033 | 1 |
| 0.20331 | 1 |
| 0.20332 | 1 |
| 0.20333 | 1 |
| 0.20334 | 1 |
| 0.20335 | 1 |
| 0.20336 | 1 |
| 0.20337 | 1 |
| 0.20338 | 1 |
| 0.20339 | 1 |
| 0.2034 | 1 |
| 0.20341 | 1 |
| 0.20342 | 1 |
| 0.20343 | 1 |
| 0.20344 | 1 |
| 0.20345 | 1 |
| 0.20346 | 1 |
| 0.20347 | 1 |
| 0.20348 | 1 |
| 0.20349 | 1 |
| 0.2035 | 1 |
| 0.20351 | 1 |
| 0.20352 | 1 |
| 0.20353 | 1 |
| 0.20354 | 1 |
| 0.20355 | 1 |
| 0.20356 | 1 |
| 0.20357 | 1 |
| 0.20358 | 1 |
| 0.20359 | 1 |
| 0.2036 | 1 |
| 0.20361 | 1 |
| 0.20362 | 1 |
| 0.20363 | 1 |
| 0.20364 | 1 |
| 0.20365 | 1 |
| 0.20366 | 1 |
| 0.20367 | 1 |
| 0.20368 | 1 |
| 0.20369 | 1 |
| 0.2037 | 1 |
| 0.20371 | 1 |
| 0.20372 | 1 |
| 0.20373 | 1 |
| 0.20374 | 1 |
| 0.20375 | 1 |
| 0.20376 | 1 |
| 0.20377 | 1 |
| 0.20378 | 1 |
| 0.20379 | 1 |
| 0.2038 | 1 |
| 0.20381 | 1 |
| 0.20382 | 1 |
| 0.20383 | 1 |
| 0.20384 | 1 |
| 0.20385 | 1 |
| 0.20386 | 1 |
| 0.20387 | 1 |
| 0.20388 | 1 |
| 0.20389 | 1 |
| 0.2039 | 1 |
| 0.20391 | 1 |
| 0.20392 | 1 |
| 0.20393 | 1 |
| 0.20394 | 1 |
| 0.20395 | 1 |
| 0.20396 | 1 |
| 0.20397 | 1 |
| 0.20398 | 1 |
| 0.20399 | 1 |
| 0.204 | 1 |
| 0.20401 | 1 |
| 0.20402 | 1 |
| 0.20403 | 1 |
| 0.20404 | 1 |
| 0.20405 | 1 |
| 0.20406 | 1 |
| 0.20407 | 1 |
| 0.20408 | 1 |
| 0.20409 | 1 |
| 0.2041 | 1 |
| 0.20411 | 1 |
| 0.20412 | 1 |
| 0.20413 | 1 |
| 0.20414 | 1 |
| 0.20415 | 1 |
| 0.20416 | 1 |
| 0.20417 | 1 |
| 0.20418 | 1 |
| 0.20419 | 1 |
| 0.2042 | 1 |
| 0.20421 | 1 |
| 0.20422 | 1 |
| 0.20423 | 1 |
| 0.20424 | 1 |
| 0.20425 | 1 |
| 0.20426 | 1 |
| 0.20427 | 1 |
| 0.20428 | 1 |
| 0.20429 | 1 |
| 0.2043 | 1 |
| 0.20431 | 1 |
| 0.20432 | 1 |
| 0.20433 | 1 |
| 0.20434 | 1 |
| 0.20435 | 1 |
| 0.20436 | 1 |
| 0.20437 | 1 |
| 0.20438 | 1 |
| 0.20439 | 1 |
| 0.2044 | 1 |
| 0.20441 | 1 |
| 0.20442 | 1 |
| 0.20443 | 1 |
| 0.20444 | 1 |
| 0.20445 | 1 |
| 0.20446 | 1 |
| 0.20447 | 1 |
| 0.20448 | 1 |
| 0.20449 | 1 |
| 0.2045 | 1 |
| 0.20451 | 1 |
| 0.20452 | 1 |
| 0.20453 | 1 |
| 0.20454 | 1 |
| 0.20455 | 1 |
| 0.20456 | 1 |
| 0.20457 | 1 |
| 0.20458 | 1 |
| 0.20459 | 1 |
| 0.2046 | 1 |
| 0.20461 | 1 |
| 0.20462 | 1 |
| 0.20463 | 1 |
| 0.20464 | 1 |
| 0.20465 | 1 |
| 0.20466 | 1 |
| 0.20467 | 1 |
| 0.20468 | 1 |
| 0.20469 | 1 |
| 0.2047 | 1 |
| 0.20471 | 1 |
| 0.20472 | 1 |
| 0.20473 | 1 |
| 0.20474 | 1 |
| 0.20475 | 1 |
| 0.20476 | 1 |
| 0.20477 | 1 |
| 0.20478 | 1 |
| 0.20479 | 1 |
| 0.2048 | 1 |
| 0.20481 | 1 |
| 0.20482 | 1 |
| 0.20483 | 1 |
| 0.20484 | 1 |
| 0.20485 | 1 |
| 0.20486 | 1 |
| 0.20487 | 1 |
| 0.20488 | 1 |
| 0.20489 | 1 |
| 0.2049 | 1 |
| 0.20491 | 1 |
| 0.20492 | 1 |
| 0.20493 | 1 |
| 0.20494 | 1 |
| 0.20495 | 1 |
| 0.20496 | 1 |
| 0.20497 | 1 |
| 0.20498 | 1 |
| 0.20499 | 1 |
| 0.205 | 1 |
| 0.20501 | 1 |
| 0.20502 | 1 |
| 0.20503 | 1 |
| 0.20504 | 1 |
| 0.20505 | 1 |
| 0.20506 | 1 |
| 0.20507 | 1 |
| 0.20508 | 1 |
| 0.20509 | 1 |
| 0.2051 | 1 |
| 0.20511 | 1 |
| 0.20512 | 1 |
| 0.20513 | 1 |
| 0.20514 | 1 |
| 0.20515 | 1 |
| 0.20516 | 1 |
| 0.20517 | 1 |
| 0.20518 | 1 |
| 0.20519 | 1 |
| 0.2052 | 1 |
| 0.20521 | 1 |
| 0.20522 | 1 |
| 0.20523 | 1 |
| 0.20524 | 1 |
| 0.20525 | 1 |
| 0.20526 | 1 |
| 0.20527 | 1 |
| 0.20528 | 1 |
| 0.20529 | 1 |
| 0.2053 | 1 |
| 0.20531 | 1 |
| 0.20532 | 1 |
| 0.20533 | 1 |
| 0.20534 | 1 |
| 0.20535 | 1 |
| 0.20536 | 1 |
| 0.20537 | 1 |
| 0.20538 | 1 |
| 0.20539 | 1 |
| 0.2054 | 1 |
| 0.20541 | 1 |
| 0.20542 | 1 |
| 0.20543 | 1 |
| 0.20544 | 1 |
| 0.20545 | 1 |
| 0.20546 | 1 |
| 0.20547 | 1 |
| 0.20548 | 1 |
| 0.20549 | 1 |
| 0.2055 | 1 |
| 0.20551 | 1 |
| 0.20552 | 1 |
| 0.20553 | 1 |
| 0.20554 | 1 |
| 0.20555 | 1 |
| 0.20556 | 1 |
| 0.20557 | 1 |
| 0.20558 | 1 |
| 0.20559 | 1 |
| 0.2056 | 1 |
| 0.20561 | 1 |
| 0.20562 | 1 |
| 0.20563 | 1 |
| 0.20564 | 1 |
| 0.20565 | 1 |
| 0.20566 | 1 |
| 0.20567 | 1 |
| 0.20568 | 1 |
| 0.20569 | 1 |
| 0.2057 | 1 |
| 0.20571 | 1 |
| 0.20572 | 1 |
| 0.20573 | 1 |
| 0.20574 | 1 |
| 0.20575 | 1 |
| 0.20576 | 1 |
| 0.20577 | 1 |
| 0.20578 | 1 |
| 0.20579 | 1 |
| 0.2058 | 1 |
| 0.20581 | 1 |
| 0.20582 | 1 |
| 0.20583 | 1 |
| 0.20584 | 1 |
| 0.20585 | 1 |
| 0.20586 | 1 |
| 0.20587 | 1 |
| 0.20588 | 1 |
| 0.20589 | 1 |
| 0.2059 | 1 |
| 0.20591 | 1 |
| 0.20592 | 1 |
| 0.20593 | 1 |
| 0.20594 | 1 |
| 0.20595 | 1 |
| 0.20596 | 1 |
| 0.20597 | 1 |
| 0.20598 | 1 |
| 0.20599 | 1 |
| 0.206 | 1 |
| 0.20601 | 1 |
| 0.20602 | 1 |
| 0.20603 | 1 |
| 0.20604 | 1 |
| 0.20605 | 1 |
| 0.20606 | 1 |
| 0.20607 | 1 |
| 0.20608 | 1 |
| 0.20609 | 1 |
| 0.2061 | 1 |
| 0.20611 | 1 |
| 0.20612 | 1 |
| 0.20613 | 1 |
| 0.20614 | 1 |
| 0.20615 | 1 |
| 0.20616 | 1 |
| 0.20617 | 1 |
| 0.20618 | 1 |
| 0.20619 | 1 |
| 0.2062 | 1 |
| 0.20621 | 1 |
| 0.20622 | 1 |
| 0.20623 | 1 |
| 0.20624 | 1 |
| 0.20625 | 1 |
| 0.20626 | 1 |
| 0.20627 | 1 |
| 0.20628 | 1 |
| 0.20629 | 1 |
| 0.2063 | 1 |
| 0.20631 | 1 |
| 0.20632 | 1 |
| 0.20633 | 1 |
| 0.20634 | 1 |
| 0.20635 | 1 |
| 0.20636 | 1 |
| 0.20637 | 1 |
| 0.20638 | 1 |
| 0.20639 | 1 |
| 0.2064 | 1 |
| 0.20641 | 1 |
| 0.20642 | 1 |
| 0.20643 | 1 |
| 0.20644 | 1 |
| 0.20645 | 1 |
| 0.20646 | 1 |
| 0.20647 | 1 |
| 0.20648 | 1 |
| 0.20649 | 1 |
| 0.2065 | 1 |
| 0.20651 | 1 |
| 0.20652 | 1 |
| 0.20653 | 1 |
| 0.20654 | 1 |
| 0.20655 | 1 |
| 0.20656 | 1 |
| 0.20657 | 1 |
| 0.20658 | 1 |
| 0.20659 | 1 |
| 0.2066 | 1 |
| 0.20661 | 1 |
| 0.20662 | 1 |
| 0.20663 | 1 |
| 0.20664 | 1 |
| 0.20665 | 1 |
| 0.20666 | 1 |
| 0.20667 | 1 |
| 0.20668 | 1 |
| 0.20669 | 1 |
| 0.2067 | 1 |
| 0.20671 | 1 |
| 0.20672 | 1 |
| 0.20673 | 1 |
| 0.20674 | 1 |
| 0.20675 | 1 |
| 0.20676 | 1 |
| 0.20677 | 1 |
| 0.20678 | 1 |
| 0.20679 | 1 |
| 0.2068 | 1 |
| 0.20681 | 1 |
| 0.20682 | 1 |
| 0.20683 | 1 |
| 0.20684 | 1 |
| 0.20685 | 1 |
| 0.20686 | 1 |
| 0.20687 | 1 |
| 0.20688 | 1 |
| 0.20689 | 1 |
| 0.2069 | 1 |
| 0.20691 | 1 |
| 0.20692 | 1 |
| 0.20693 | 1 |
| 0.20694 | 1 |
| 0.20695 | 1 |
| 0.20696 | 1 |
| 0.20697 | 1 |
| 0.20698 | 1 |
| 0.20699 | 1 |
| 0.207 | 1 |
| 0.20701 | 1 |
| 0.20702 | 1 |
| 0.20703 | 1 |
| 0.20704 | 1 |
| 0.20705 | 1 |
| 0.20706 | 1 |
| 0.20707 | 1 |
| 0.20708 | 1 |
| 0.20709 | 1 |
| 0.2071 | 1 |
| 0.20711 | 1 |
| 0.20712 | 1 |
| 0.20713 | 1 |
| 0.20714 | 1 |
| 0.20715 | 1 |
| 0.20716 | 1 |
| 0.20717 | 1 |
| 0.20718 | 1 |
| 0.20719 | 1 |
| 0.2072 | 1 |
| 0.20721 | 1 |
| 0.20722 | 1 |
| 0.20723 | 1 |
| 0.20724 | 1 |
| 0.20725 | 1 |
| 0.20726 | 1 |
| 0.20727 | 1 |
| 0.20728 | 1 |
| 0.20729 | 1 |
| 0.2073 | 1 |
| 0.20731 | 1 |
| 0.20732 | 1 |
| 0.20733 | 1 |
| 0.20734 | 1 |
| 0.20735 | 1 |
| 0.20736 | 1 |
| 0.20737 | 1 |
| 0.20738 | 1 |
| 0.20739 | 1 |
| 0.2074 | 1 |
| 0.20741 | 1 |
| 0.20742 | 1 |
| 0.20743 | 1 |
| 0.20744 | 1 |
| 0.20745 | 1 |
| 0.20746 | 1 |
| 0.20747 | 1 |
| 0.20748 | 1 |
| 0.20749 | 1 |
| 0.2075 | 1 |
| 0.20751 | 1 |
| 0.20752 | 1 |
| 0.20753 | 1 |
| 0.20754 | 1 |
| 0.20755 | 1 |
| 0.20756 | 1 |
| 0.20757 | 1 |
| 0.20758 | 1 |
| 0.20759 | 1 |
| 0.2076 | 1 |
| 0.20761 | 1 |
| 0.20762 | 1 |
| 0.20763 | 1 |
| 0.20764 | 1 |
| 0.20765 | 1 |
| 0.20766 | 1 |
| 0.20767 | 1 |
| 0.20768 | 1 |
| 0.20769 | 1 |
| 0.2077 | 1 |
| 0.20771 | 1 |
| 0.20772 | 1 |
| 0.20773 | 1 |
| 0.20774 | 1 |
| 0.20775 | 1 |
| 0.20776 | 1 |
| 0.20777 | 1 |
| 0.20778 | 1 |
| 0.20779 | 1 |
| 0.2078 | 1 |
| 0.20781 | 1 |
| 0.20782 | 1 |
| 0.20783 | 1 |
| 0.20784 | 1 |
| 0.20785 | 1 |
| 0.20786 | 1 |
| 0.20787 | 1 |
| 0.20788 | 1 |
| 0.20789 | 1 |
| 0.2079 | 1 |
| 0.20791 | 1 |
| 0.20792 | 1 |
| 0.20793 | 1 |
| 0.20794 | 1 |
| 0.20795 | 1 |
| 0.20796 | 1 |
| 0.20797 | 1 |
| 0.20798 | 1 |
| 0.20799 | 1 |
| 0.208 | 1 |
| 0.20801 | 1 |
| 0.20802 | 1 |
| 0.20803 | 1 |
| 0.20804 | 1 |
| 0.20805 | 1 |
| 0.20806 | 1 |
| 0.20807 | 1 |
| 0.20808 | 1 |
| 0.20809 | 1 |
| 0.2081 | 1 |
| 0.20811 | 1 |
| 0.20812 | 1 |
| 0.20813 | 1 |
| 0.20814 | 1 |
| 0.20815 | 1 |
| 0.20816 | 1 |
| 0.20817 | 1 |
| 0.20818 | 1 |
| 0.20819 | 1 |
| 0.2082 | 1 |
| 0.20821 | 1 |
| 0.20822 | 1 |
| 0.20823 | 1 |
| 0.20824 | 1 |
| 0.20825 | 1 |
| 0.20826 | 1 |
| 0.20827 | 1 |
| 0.20828 | 1 |
| 0.20829 | 1 |
| 0.2083 | 1 |
| 0.20831 | 1 |
| 0.20832 | 1 |
| 0.20833 | 1 |
| 0.20834 | 1 |
| 0.20835 | 1 |
| 0.20836 | 1 |
| 0.20837 | 1 |
| 0.20838 | 1 |
| 0.20839 | 1 |
| 0.2084 | 1 |
| 0.20841 | 1 |
| 0.20842 | 1 |
| 0.20843 | 1 |
| 0.20844 | 1 |
| 0.20845 | 1 |
| 0.20846 | 1 |
| 0.20847 | 1 |
| 0.20848 | 1 |
| 0.20849 | 1 |
| 0.2085 | 1 |
| 0.20851 | 1 |
| 0.20852 | 1 |
| 0.20853 | 1 |
| 0.20854 | 1 |
| 0.20855 | 1 |
| 0.20856 | 1 |
| 0.20857 | 1 |
| 0.20858 | 1 |
| 0.20859 | 1 |
| 0.2086 | 1 |
| 0.20861 | 1 |
| 0.20862 | 1 |
| 0.20863 | 1 |
| 0.20864 | 1 |
| 0.20865 | 1 |
| 0.20866 | 1 |
| 0.20867 | 1 |
| 0.20868 | 1 |
| 0.20869 | 1 |
| 0.2087 | 1 |
| 0.20871 | 1 |
| 0.20872 | 1 |
| 0.20873 | 1 |
| 0.20874 | 1 |
| 0.20875 | 1 |
| 0.20876 | 1 |
| 0.20877 | 1 |
| 0.20878 | 1 |
| 0.20879 | 1 |
| 0.2088 | 1 |
| 0.20881 | 1 |
| 0.20882 | 1 |
| 0.20883 | 1 |
| 0.20884 | 1 |
| 0.20885 | 1 |
| 0.20886 | 1 |
| 0.20887 | 1 |
| 0.20888 | 1 |
| 0.20889 | 1 |
| 0.2089 | 1 |
| 0.20891 | 1 |
| 0.20892 | 1 |
| 0.20893 | 1 |
| 0.20894 | 1 |
| 0.20895 | 1 |
| 0.20896 | 1 |
| 0.20897 | 1 |
| 0.20898 | 1 |
| 0.20899 | 1 |
| 0.209 | 1 |
| 0.20901 | 1 |
| 0.20902 | 1 |
| 0.20903 | 1 |
| 0.20904 | 1 |
| 0.20905 | 1 |
| 0.20906 | 1 |
| 0.20907 | 1 |
| 0.20908 | 1 |
| 0.20909 | 1 |
| 0.2091 | 1 |
| 0.20911 | 1 |
| 0.20912 | 1 |
| 0.20913 | 1 |
| 0.20914 | 1 |
| 0.20915 | 1 |
| 0.20916 | 1 |
| 0.20917 | 1 |
| 0.20918 | 1 |
| 0.20919 | 1 |
| 0.2092 | 1 |
| 0.20921 | 1 |
| 0.20922 | 1 |
| 0.20923 | 1 |
| 0.20924 | 1 |
| 0.20925 | 1 |
| 0.20926 | 1 |
| 0.20927 | 1 |
| 0.20928 | 1 |
| 0.20929 | 1 |
| 0.2093 | 1 |
| 0.20931 | 1 |
| 0.20932 | 1 |
| 0.20933 | 1 |
| 0.20934 | 1 |
| 0.20935 | 1 |
| 0.20936 | 1 |
| 0.20937 | 1 |
| 0.20938 | 1 |
| 0.20939 | 1 |
| 0.2094 | 1 |
| 0.20941 | 1 |
| 0.20942 | 1 |
| 0.20943 | 1 |
| 0.20944 | 1 |
| 0.20945 | 1 |
| 0.20946 | 1 |
| 0.20947 | 1 |
| 0.20948 | 1 |
| 0.20949 | 1 |
| 0.2095 | 1 |
| 0.20951 | 1 |
| 0.20952 | 1 |
| 0.20953 | 1 |
| 0.20954 | 1 |
| 0.20955 | 1 |
| 0.20956 | 1 |
| 0.20957 | 1 |
| 0.20958 | 1 |
| 0.20959 | 1 |
| 0.2096 | 1 |
| 0.20961 | 1 |
| 0.20962 | 1 |
| 0.20963 | 1 |
| 0.20964 | 1 |
| 0.20965 | 1 |
| 0.20966 | 1 |
| 0.20967 | 1 |
| 0.20968 | 1 |
| 0.20969 | 1 |
| 0.2097 | 1 |
| 0.20971 | 1 |
| 0.20972 | 1 |
| 0.20973 | 1 |
| 0.20974 | 1 |
| 0.20975 | 1 |
| 0.20976 | 1 |
| 0.20977 | 1 |
| 0.20978 | 1 |
| 0.20979 | 1 |
| 0.2098 | 1 |
| 0.20981 | 1 |
| 0.20982 | 1 |
| 0.20983 | 1 |
| 0.20984 | 1 |
| 0.20985 | 1 |
| 0.20986 | 1 |
| 0.20987 | 1 |
| 0.20988 | 1 |
| 0.20989 | 1 |
| 0.2099 | 1 |
| 0.20991 | 1 |
| 0.20992 | 1 |
| 0.20993 | 1 |
| 0.20994 | 1 |
| 0.20995 | 1 |
| 0.20996 | 1 |
| 0.20997 | 1 |
| 0.20998 | 1 |
| 0.20999 | 1 |
| 0.21 | 1 |
| 0.21001 | 1 |
| 0.21002 | 1 |
| 0.21003 | 1 |
| 0.21004 | 1 |
| 0.21005 | 1 |
| 0.21006 | 1 |
| 0.21007 | 1 |
| 0.21008 | 1 |
| 0.21009 | 1 |
| 0.2101 | 1 |
| 0.21011 | 1 |
| 0.21012 | 1 |
| 0.21013 | 1 |
| 0.21014 | 1 |
| 0.21015 | 1 |
| 0.21016 | 1 |
| 0.21017 | 1 |
| 0.21018 | 1 |
| 0.21019 | 1 |
| 0.2102 | 1 |
| 0.21021 | 1 |
| 0.21022 | 1 |
| 0.21023 | 1 |
| 0.21024 | 1 |
| 0.21025 | 1 |
| 0.21026 | 1 |
| 0.21027 | 1 |
| 0.21028 | 1 |
| 0.21029 | 1 |
| 0.2103 | 1 |
| 0.21031 | 1 |
| 0.21032 | 1 |
| 0.21033 | 1 |
| 0.21034 | 1 |
| 0.21035 | 1 |
| 0.21036 | 1 |
| 0.21037 | 1 |
| 0.21038 | 1 |
| 0.21039 | 1 |
| 0.2104 | 1 |
| 0.21041 | 1 |
| 0.21042 | 1 |
| 0.21043 | 1 |
| 0.21044 | 1 |
| 0.21045 | 1 |
| 0.21046 | 1 |
| 0.21047 | 1 |
| 0.21048 | 1 |
| 0.21049 | 1 |
| 0.2105 | 1 |
| 0.21051 | 1 |
| 0.21052 | 1 |
| 0.21053 | 1 |
| 0.21054 | 1 |
| 0.21055 | 1 |
| 0.21056 | 1 |
| 0.21057 | 1 |
| 0.21058 | 1 |
| 0.21059 | 1 |
| 0.2106 | 1 |
| 0.21061 | 1 |
| 0.21062 | 1 |
| 0.21063 | 1 |
| 0.21064 | 1 |
| 0.21065 | 1 |
| 0.21066 | 1 |
| 0.21067 | 1 |
| 0.21068 | 1 |
| 0.21069 | 1 |
| 0.2107 | 1 |
| 0.21071 | 1 |
| 0.21072 | 1 |
| 0.21073 | 1 |
| 0.21074 | 1 |
| 0.21075 | 1 |
| 0.21076 | 1 |
| 0.21077 | 1 |
| 0.21078 | 1 |
| 0.21079 | 1 |
| 0.2108 | 1 |
| 0.21081 | 1 |
| 0.21082 | 1 |
| 0.21083 | 1 |
| 0.21084 | 1 |
| 0.21085 | 1 |
| 0.21086 | 1 |
| 0.21087 | 1 |
| 0.21088 | 1 |
| 0.21089 | 1 |
| 0.2109 | 1 |
| 0.21091 | 1 |
| 0.21092 | 1 |
| 0.21093 | 1 |
| 0.21094 | 1 |
| 0.21095 | 1 |
| 0.21096 | 1 |
| 0.21097 | 1 |
| 0.21098 | 1 |
| 0.21099 | 1 |
| 0.211 | 1 |
| 0.21101 | 1 |
| 0.21102 | 1 |
| 0.21103 | 1 |
| 0.21104 | 1 |
| 0.21105 | 1 |
| 0.21106 | 1 |
| 0.21107 | 1 |
| 0.21108 | 1 |
| 0.21109 | 1 |
| 0.2111 | 1 |
| 0.21111 | 1 |
| 0.21112 | 1 |
| 0.21113 | 1 |
| 0.21114 | 1 |
| 0.21115 | 1 |
| 0.21116 | 1 |
| 0.21117 | 1 |
| 0.21118 | 1 |
| 0.21119 | 1 |
| 0.2112 | 1 |
| 0.21121 | 1 |
| 0.21122 | 1 |
| 0.21123 | 1 |
| 0.21124 | 1 |
| 0.21125 | 1 |
| 0.21126 | 1 |
| 0.21127 | 1 |
| 0.21128 | 1 |
| 0.21129 | 1 |
| 0.2113 | 1 |
| 0.21131 | 1 |
| 0.21132 | 1 |
| 0.21133 | 1 |
| 0.21134 | 1 |
| 0.21135 | 1 |
| 0.21136 | 1 |
| 0.21137 | 1 |
| 0.21138 | 1 |
| 0.21139 | 1 |
| 0.2114 | 1 |
| 0.21141 | 1 |
| 0.21142 | 1 |
| 0.21143 | 1 |
| 0.21144 | 1 |
| 0.21145 | 1 |
| 0.21146 | 1 |
| 0.21147 | 1 |
| 0.21148 | 1 |
| 0.21149 | 1 |
| 0.2115 | 1 |
| 0.21151 | 1 |
| 0.21152 | 1 |
| 0.21153 | 1 |
| 0.21154 | 1 |
| 0.21155 | 1 |
| 0.21156 | 1 |
| 0.21157 | 1 |
| 0.21158 | 1 |
| 0.21159 | 1 |
| 0.2116 | 1 |
| 0.21161 | 1 |
| 0.21162 | 1 |
| 0.21163 | 1 |
| 0.21164 | 1 |
| 0.21165 | 1 |
| 0.21166 | 1 |
| 0.21167 | 1 |
| 0.21168 | 1 |
| 0.21169 | 1 |
| 0.2117 | 1 |
| 0.21171 | 1 |
| 0.21172 | 1 |
| 0.21173 | 1 |
| 0.21174 | 1 |
| 0.21175 | 1 |
| 0.21176 | 1 |
| 0.21177 | 1 |
| 0.21178 | 1 |
| 0.21179 | 1 |
| 0.2118 | 1 |
| 0.21181 | 1 |
| 0.21182 | 1 |
| 0.21183 | 1 |
| 0.21184 | 1 |
| 0.21185 | 1 |
| 0.21186 | 1 |
| 0.21187 | 1 |
| 0.21188 | 1 |
| 0.21189 | 1 |
| 0.2119 | 1 |
| 0.21191 | 1 |
| 0.21192 | 1 |
| 0.21193 | 1 |
| 0.21194 | 1 |
| 0.21195 | 1 |
| 0.21196 | 1 |
| 0.21197 | 1 |
| 0.21198 | 1 |
| 0.21199 | 1 |
| 0.212 | 1 |
| 0.21201 | 1 |
| 0.21202 | 1 |
| 0.21203 | 1 |
| 0.21204 | 1 |
| 0.21205 | 1 |
| 0.21206 | 1 |
| 0.21207 | 1 |
| 0.21208 | 1 |
| 0.21209 | 1 |
| 0.2121 | 1 |
| 0.21211 | 1 |
| 0.21212 | 1 |
| 0.21213 | 1 |
| 0.21214 | 1 |
| 0.21215 | 1 |
| 0.21216 | 1 |
| 0.21217 | 1 |
| 0.21218 | 1 |
| 0.21219 | 1 |
| 0.2122 | 1 |
| 0.21221 | 1 |
| 0.21222 | 1 |
| 0.21223 | 1 |
| 0.21224 | 1 |
| 0.21225 | 1 |
| 0.21226 | 1 |
| 0.21227 | 1 |
| 0.21228 | 1 |
| 0.21229 | 1 |
| 0.2123 | 1 |
| 0.21231 | 1 |
| 0.21232 | 1 |
| 0.21233 | 1 |
| 0.21234 | 1 |
| 0.21235 | 1 |
| 0.21236 | 1 |
| 0.21237 | 1 |
| 0.21238 | 1 |
| 0.21239 | 1 |
| 0.2124 | 1 |
| 0.21241 | 1 |
| 0.21242 | 1 |
| 0.21243 | 1 |
| 0.21244 | 1 |
| 0.21245 | 1 |
| 0.21246 | 1 |
| 0.21247 | 1 |
| 0.21248 | 1 |
| 0.21249 | 1 |
| 0.2125 | 1 |
| 0.21251 | 1 |
| 0.21252 | 1 |
| 0.21253 | 1 |
| 0.21254 | 1 |
| 0.21255 | 1 |
| 0.21256 | 1 |
| 0.21257 | 1 |
| 0.21258 | 1 |
| 0.21259 | 1 |
| 0.2126 | 1 |
| 0.21261 | 1 |
| 0.21262 | 1 |
| 0.21263 | 1 |
| 0.21264 | 1 |
| 0.21265 | 1 |
| 0.21266 | 1 |
| 0.21267 | 1 |
| 0.21268 | 1 |
| 0.21269 | 1 |
| 0.2127 | 0.999 |
| 0.21271 | 0.999 |
| 0.21272 | 0.999 |
| 0.21273 | 0.999 |
| 0.21274 | 0.999 |
| 0.21275 | 0.999 |
| 0.21276 | 0.999 |
| 0.21277 | 0.999 |
| 0.21278 | 0.999 |
| 0.21279 | 0.999 |
| 0.2128 | 0.999 |
| 0.21281 | 0.999 |
| 0.21282 | 0.999 |
| 0.21283 | 0.999 |
| 0.21284 | 0.999 |
| 0.21285 | 0.999 |
| 0.21286 | 0.999 |
| 0.21287 | 0.999 |
| 0.21288 | 0.999 |
| 0.21289 | 0.999 |
| 0.2129 | 0.999 |
| 0.21291 | 0.999 |
| 0.21292 | 0.999 |
| 0.21293 | 0.999 |
| 0.21294 | 0.999 |
| 0.21295 | 0.999 |
| 0.21296 | 0.999 |
| 0.21297 | 0.999 |
| 0.21298 | 0.999 |
| 0.21299 | 0.999 |
| 0.213 | 0.999 |
| 0.21301 | 0.999 |
| 0.21302 | 0.999 |
| 0.21303 | 0.999 |
| 0.21304 | 0.999 |
| 0.21305 | 0.999 |
| 0.21306 | 0.999 |
| 0.21307 | 0.999 |
| 0.21308 | 0.999 |
| 0.21309 | 0.999 |
| 0.2131 | 0.999 |
| 0.21311 | 0.999 |
| 0.21312 | 0.999 |
| 0.21313 | 0.999 |
| 0.21314 | 0.999 |
| 0.21315 | 0.999 |
| 0.21316 | 0.999 |
| 0.21317 | 0.999 |
| 0.21318 | 0.999 |
| 0.21319 | 0.999 |
| 0.2132 | 0.999 |
| 0.21321 | 0.999 |
| 0.21322 | 0.999 |
| 0.21323 | 0.999 |
| 0.21324 | 0.999 |
| 0.21325 | 0.999 |
| 0.21326 | 0.999 |
| 0.21327 | 0.999 |
| 0.21328 | 0.999 |
| 0.21329 | 0.999 |
| 0.2133 | 0.999 |
| 0.21331 | 0.999 |
| 0.21332 | 0.999 |
| 0.21333 | 0.999 |
| 0.21334 | 0.999 |
| 0.21335 | 0.999 |
| 0.21336 | 0.999 |
| 0.21337 | 0.999 |
| 0.21338 | 0.999 |
| 0.21339 | 0.999 |
| 0.2134 | 0.999 |
| 0.21341 | 0.999 |
| 0.21342 | 0.999 |
| 0.21343 | 0.999 |
| 0.21344 | 0.999 |
| 0.21345 | 0.999 |
| 0.21346 | 0.999 |
| 0.21347 | 0.999 |
| 0.21348 | 0.999 |
| 0.21349 | 0.999 |
| 0.2135 | 0.999 |
| 0.21351 | 0.999 |
| 0.21352 | 0.999 |
| 0.21353 | 0.999 |
| 0.21354 | 0.999 |
| 0.21355 | 0.999 |
| 0.21356 | 0.999 |
| 0.21357 | 0.999 |
| 0.21358 | 0.999 |
| 0.21359 | 0.999 |
| 0.2136 | 0.999 |
| 0.21361 | 0.999 |
| 0.21362 | 0.999 |
| 0.21363 | 0.999 |
| 0.21364 | 0.999 |
| 0.21365 | 0.999 |
| 0.21366 | 0.999 |
| 0.21367 | 0.999 |
| 0.21368 | 0.999 |
| 0.21369 | 0.999 |
| 0.2137 | 0.999 |
| 0.21371 | 0.999 |
| 0.21372 | 0.999 |
| 0.21373 | 0.999 |
| 0.21374 | 0.999 |
| 0.21375 | 0.999 |
| 0.21376 | 0.999 |
| 0.21377 | 0.999 |
| 0.21378 | 0.999 |
| 0.21379 | 0.999 |
| 0.2138 | 0.999 |
| 0.21381 | 0.999 |
| 0.21382 | 0.999 |
| 0.21383 | 0.999 |
| 0.21384 | 0.999 |
| 0.21385 | 0.999 |
| 0.21386 | 0.999 |
| 0.21387 | 0.999 |
| 0.21388 | 0.999 |
| 0.21389 | 0.999 |
| 0.2139 | 0.999 |
| 0.21391 | 0.999 |
| 0.21392 | 0.999 |
| 0.21393 | 0.999 |
| 0.21394 | 0.999 |
| 0.21395 | 0.999 |
| 0.21396 | 0.999 |
| 0.21397 | 0.999 |
| 0.21398 | 0.999 |
| 0.21399 | 0.999 |
| 0.214 | 0.999 |
| 0.21401 | 0.999 |
| 0.21402 | 0.999 |
| 0.21403 | 0.999 |
| 0.21404 | 0.999 |
| 0.21405 | 0.999 |
| 0.21406 | 0.999 |
| 0.21407 | 0.999 |
| 0.21408 | 0.999 |
| 0.21409 | 0.999 |
| 0.2141 | 0.999 |
| 0.21411 | 0.999 |
| 0.21412 | 0.999 |
| 0.21413 | 0.999 |
| 0.21414 | 0.999 |
| 0.21415 | 0.999 |
| 0.21416 | 0.999 |
| 0.21417 | 0.999 |
| 0.21418 | 0.999 |
| 0.21419 | 0.999 |
| 0.2142 | 0.999 |
| 0.21421 | 0.999 |
| 0.21422 | 0.999 |
| 0.21423 | 0.999 |
| 0.21424 | 0.999 |
| 0.21425 | 0.999 |
| 0.21426 | 0.999 |
| 0.21427 | 0.999 |
| 0.21428 | 0.999 |
| 0.21429 | 0.999 |
| 0.2143 | 0.999 |
| 0.21431 | 0.999 |
| 0.21432 | 0.999 |
| 0.21433 | 0.999 |
| 0.21434 | 0.999 |
| 0.21435 | 0.999 |
| 0.21436 | 0.999 |
| 0.21437 | 0.999 |
| 0.21438 | 0.999 |
| 0.21439 | 0.999 |
| 0.2144 | 0.999 |
| 0.21441 | 0.999 |
| 0.21442 | 0.999 |
| 0.21443 | 0.999 |
| 0.21444 | 0.999 |
| 0.21445 | 0.999 |
| 0.21446 | 0.999 |
| 0.21447 | 0.999 |
| 0.21448 | 0.999 |
| 0.21449 | 0.999 |
| 0.2145 | 0.999 |
| 0.21451 | 0.999 |
| 0.21452 | 0.999 |
| 0.21453 | 0.999 |
| 0.21454 | 0.999 |
| 0.21455 | 0.999 |
| 0.21456 | 0.999 |
| 0.21457 | 0.999 |
| 0.21458 | 0.999 |
| 0.21459 | 0.999 |
| 0.2146 | 0.999 |
| 0.21461 | 0.999 |
| 0.21462 | 0.999 |
| 0.21463 | 0.999 |
| 0.21464 | 0.999 |
| 0.21465 | 0.999 |
| 0.21466 | 0.999 |
| 0.21467 | 0.999 |
| 0.21468 | 0.999 |
| 0.21469 | 0.999 |
| 0.2147 | 0.999 |
| 0.21471 | 0.999 |
| 0.21472 | 0.999 |
| 0.21473 | 0.999 |
| 0.21474 | 0.999 |
| 0.21475 | 0.999 |
| 0.21476 | 0.999 |
| 0.21477 | 0.999 |
| 0.21478 | 0.999 |
| 0.21479 | 0.999 |
| 0.2148 | 0.999 |
| 0.21481 | 0.999 |
| 0.21482 | 0.999 |
| 0.21483 | 0.999 |
| 0.21484 | 0.999 |
| 0.21485 | 0.999 |
| 0.21486 | 0.999 |
| 0.21487 | 0.999 |
| 0.21488 | 0.999 |
| 0.21489 | 0.999 |
| 0.2149 | 0.999 |
| 0.21491 | 0.999 |
| 0.21492 | 0.999 |
| 0.21493 | 0.999 |
| 0.21494 | 0.999 |
| 0.21495 | 0.999 |
| 0.21496 | 0.999 |
| 0.21497 | 0.999 |
| 0.21498 | 0.999 |
| 0.21499 | 0.999 |
| 0.215 | 0.999 |
| 0.21501 | 0.999 |
| 0.21502 | 0.999 |
| 0.21503 | 0.999 |
| 0.21504 | 0.999 |
| 0.21505 | 0.999 |
| 0.21506 | 0.999 |
| 0.21507 | 0.999 |
| 0.21508 | 0.999 |
| 0.21509 | 0.999 |
| 0.2151 | 0.999 |
| 0.21511 | 0.999 |
| 0.21512 | 0.999 |
| 0.21513 | 0.999 |
| 0.21514 | 0.999 |
| 0.21515 | 0.999 |
| 0.21516 | 0.999 |
| 0.21517 | 0.999 |
| 0.21518 | 0.999 |
| 0.21519 | 0.999 |
| 0.2152 | 0.999 |
| 0.21521 | 0.999 |
| 0.21522 | 0.999 |
| 0.21523 | 0.999 |
| 0.21524 | 0.999 |
| 0.21525 | 0.999 |
| 0.21526 | 0.999 |
| 0.21527 | 0.999 |
| 0.21528 | 0.999 |
| 0.21529 | 0.999 |
| 0.2153 | 0.999 |
| 0.21531 | 0.999 |
| 0.21532 | 0.999 |
| 0.21533 | 0.999 |
| 0.21534 | 0.999 |
| 0.21535 | 0.999 |
| 0.21536 | 0.999 |
| 0.21537 | 0.999 |
| 0.21538 | 0.999 |
| 0.21539 | 0.999 |
| 0.2154 | 0.999 |
| 0.21541 | 0.999 |
| 0.21542 | 0.999 |
| 0.21543 | 0.999 |
| 0.21544 | 0.999 |
| 0.21545 | 0.999 |
| 0.21546 | 0.999 |
| 0.21547 | 0.999 |
| 0.21548 | 0.999 |
| 0.21549 | 0.999 |
| 0.2155 | 0.999 |
| 0.21551 | 0.999 |
| 0.21552 | 0.999 |
| 0.21553 | 0.999 |
| 0.21554 | 0.999 |
| 0.21555 | 0.999 |
| 0.21556 | 0.999 |
| 0.21557 | 0.999 |
| 0.21558 | 0.999 |
| 0.21559 | 0.999 |
| 0.2156 | 0.999 |
| 0.21561 | 0.999 |
| 0.21562 | 0.999 |
| 0.21563 | 0.999 |
| 0.21564 | 0.999 |
| 0.21565 | 0.999 |
| 0.21566 | 0.999 |
| 0.21567 | 0.999 |
| 0.21568 | 0.999 |
| 0.21569 | 0.999 |
| 0.2157 | 0.999 |
| 0.21571 | 0.999 |
| 0.21572 | 0.999 |
| 0.21573 | 0.999 |
| 0.21574 | 0.999 |
| 0.21575 | 0.999 |
| 0.21576 | 0.999 |
| 0.21577 | 0.999 |
| 0.21578 | 0.999 |
| 0.21579 | 0.999 |
| 0.2158 | 0.999 |
| 0.21581 | 0.999 |
| 0.21582 | 0.999 |
| 0.21583 | 0.999 |
| 0.21584 | 0.999 |
| 0.21585 | 0.999 |
| 0.21586 | 0.999 |
| 0.21587 | 0.999 |
| 0.21588 | 0.999 |
| 0.21589 | 0.999 |
| 0.2159 | 0.999 |
| 0.21591 | 0.999 |
| 0.21592 | 0.999 |
| 0.21593 | 0.999 |
| 0.21594 | 0.999 |
| 0.21595 | 0.999 |
| 0.21596 | 0.999 |
| 0.21597 | 0.999 |
| 0.21598 | 0.999 |
| 0.21599 | 0.999 |
| 0.216 | 0.999 |
| 0.21601 | 0.999 |
| 0.21602 | 0.999 |
| 0.21603 | 0.999 |
| 0.21604 | 0.999 |
| 0.21605 | 0.999 |
| 0.21606 | 0.999 |
| 0.21607 | 0.999 |
| 0.21608 | 0.999 |
| 0.21609 | 0.999 |
| 0.2161 | 0.999 |
| 0.21611 | 0.999 |
| 0.21612 | 0.999 |
| 0.21613 | 0.999 |
| 0.21614 | 0.999 |
| 0.21615 | 0.999 |
| 0.21616 | 0.999 |
| 0.21617 | 0.999 |
| 0.21618 | 0.999 |
| 0.21619 | 0.999 |
| 0.2162 | 0.999 |
| 0.21621 | 0.999 |
| 0.21622 | 0.999 |
| 0.21623 | 0.999 |
| 0.21624 | 0.999 |
| 0.21625 | 0.999 |
| 0.21626 | 0.999 |
| 0.21627 | 0.999 |
| 0.21628 | 1 |
| 0.21629 | 1 |
| 0.2163 | 1 |
| 0.21631 | 1 |
| 0.21632 | 1 |
| 0.21633 | 1 |
| 0.21634 | 1 |
| 0.21635 | 1 |
| 0.21636 | 1 |
| 0.21637 | 1 |
| 0.21638 | 1 |
| 0.21639 | 1 |
| 0.2164 | 1 |
| 0.21641 | 1 |
| 0.21642 | 1 |
| 0.21643 | 1 |
| 0.21644 | 1 |
| 0.21645 | 1 |
| 0.21646 | 1 |
| 0.21647 | 1 |
| 0.21648 | 1 |
| 0.21649 | 1 |
| 0.2165 | 1 |
| 0.21651 | 1 |
| 0.21652 | 1 |
| 0.21653 | 1 |
| 0.21654 | 1 |
| 0.21655 | 1 |
| 0.21656 | 1 |
| 0.21657 | 1 |
| 0.21658 | 1 |
| 0.21659 | 1 |
| 0.2166 | 1 |
| 0.21661 | 1 |
| 0.21662 | 1 |
| 0.21663 | 1 |
| 0.21664 | 1 |
| 0.21665 | 1 |
| 0.21666 | 1 |
| 0.21667 | 1 |
| 0.21668 | 1 |
| 0.21669 | 1 |
| 0.2167 | 1 |
| 0.21671 | 1 |
| 0.21672 | 1 |
| 0.21673 | 1 |
| 0.21674 | 1 |
| 0.21675 | 1 |
| 0.21676 | 1 |
| 0.21677 | 1 |
| 0.21678 | 1 |
| 0.21679 | 1 |
| 0.2168 | 1 |
| 0.21681 | 1 |
| 0.21682 | 1 |
| 0.21683 | 1 |
| 0.21684 | 1 |
| 0.21685 | 1 |
| 0.21686 | 1 |
| 0.21687 | 1 |
| 0.21688 | 1 |
| 0.21689 | 1 |
| 0.2169 | 1 |
| 0.21691 | 1 |
| 0.21692 | 1 |
| 0.21693 | 1 |
| 0.21694 | 1 |
| 0.21695 | 1 |
| 0.21696 | 1 |
| 0.21697 | 1 |
| 0.21698 | 1 |
| 0.21699 | 1 |
| 0.217 | 1 |
| 0.21701 | 1 |
| 0.21702 | 1 |
| 0.21703 | 1 |
| 0.21704 | 1 |
| 0.21705 | 1 |
| 0.21706 | 1 |
| 0.21707 | 1 |
| 0.21708 | 1 |
| 0.21709 | 1 |
| 0.2171 | 1 |
| 0.21711 | 1 |
| 0.21712 | 1 |
| 0.21713 | 1 |
| 0.21714 | 1 |
| 0.21715 | 1 |
| 0.21716 | 1 |
| 0.21717 | 1 |
| 0.21718 | 1 |
| 0.21719 | 1 |
| 0.2172 | 1 |
| 0.21721 | 1 |
| 0.21722 | 1 |
| 0.21723 | 1 |
| 0.21724 | 1 |
| 0.21725 | 1 |
| 0.21726 | 1 |
| 0.21727 | 1 |
| 0.21728 | 1 |
| 0.21729 | 1 |
| 0.2173 | 1 |
| 0.21731 | 1 |
| 0.21732 | 1 |
| 0.21733 | 1 |
| 0.21734 | 1 |
| 0.21735 | 1 |
| 0.21736 | 1 |
| 0.21737 | 1 |
| 0.21738 | 1 |
| 0.21739 | 1 |
| 0.2174 | 1 |
| 0.21741 | 1 |
| 0.21742 | 1 |
| 0.21743 | 1 |
| 0.21744 | 1 |
| 0.21745 | 1 |
| 0.21746 | 1 |
| 0.21747 | 1 |
| 0.21748 | 1 |
| 0.21749 | 1 |
| 0.2175 | 1 |
| 0.21751 | 1 |
| 0.21752 | 1 |
| 0.21753 | 1 |
| 0.21754 | 1 |
| 0.21755 | 1 |
| 0.21756 | 1 |
| 0.21757 | 1 |
| 0.21758 | 1 |
| 0.21759 | 1 |
| 0.2176 | 1 |
| 0.21761 | 1 |
| 0.21762 | 1 |
| 0.21763 | 1 |
| 0.21764 | 1 |
| 0.21765 | 1 |
| 0.21766 | 1 |
| 0.21767 | 1 |
| 0.21768 | 1 |
| 0.21769 | 1 |
| 0.2177 | 1 |
| 0.21771 | 1 |
| 0.21772 | 1 |
| 0.21773 | 1 |
| 0.21774 | 1 |
| 0.21775 | 1 |
| 0.21776 | 1 |
| 0.21777 | 1 |
| 0.21778 | 1 |
| 0.21779 | 1 |
| 0.2178 | 1 |
| 0.21781 | 1 |
| 0.21782 | 1 |
| 0.21783 | 1 |
| 0.21784 | 1 |
| 0.21785 | 1 |
| 0.21786 | 1 |
| 0.21787 | 1 |
| 0.21788 | 1 |
| 0.21789 | 1 |
| 0.2179 | 1 |
| 0.21791 | 1 |
| 0.21792 | 1 |
| 0.21793 | 1 |
| 0.21794 | 1 |
| 0.21795 | 1 |
| 0.21796 | 1 |
| 0.21797 | 1 |
| 0.21798 | 1 |
| 0.21799 | 1 |
| 0.218 | 1 |
| 0.21801 | 1 |
| 0.21802 | 1 |
| 0.21803 | 1 |
| 0.21804 | 1 |
| 0.21805 | 1 |
| 0.21806 | 1 |
| 0.21807 | 1 |
| 0.21808 | 1 |
| 0.21809 | 1 |
| 0.2181 | 1 |
| 0.21811 | 1 |
| 0.21812 | 1 |
| 0.21813 | 1 |
| 0.21814 | 1 |
| 0.21815 | 1 |
| 0.21816 | 1 |
| 0.21817 | 1 |
| 0.21818 | 1 |
| 0.21819 | 1 |
| 0.2182 | 1 |
| 0.21821 | 1 |
| 0.21822 | 1 |
| 0.21823 | 1 |
| 0.21824 | 1 |
| 0.21825 | 1 |
| 0.21826 | 1 |
| 0.21827 | 1 |
| 0.21828 | 1 |
| 0.21829 | 1 |
| 0.2183 | 1 |
| 0.21831 | 1 |
| 0.21832 | 1 |
| 0.21833 | 1 |
| 0.21834 | 1 |
| 0.21835 | 1 |
| 0.21836 | 1 |
| 0.21837 | 1 |
| 0.21838 | 1 |
| 0.21839 | 1 |
| 0.2184 | 1 |
| 0.21841 | 1 |
| 0.21842 | 1 |
| 0.21843 | 1 |
| 0.21844 | 1 |
| 0.21845 | 1 |
| 0.21846 | 1 |
| 0.21847 | 1 |
| 0.21848 | 1 |
| 0.21849 | 1 |
| 0.2185 | 1 |
| 0.21851 | 1 |
| 0.21852 | 1 |
| 0.21853 | 1 |
| 0.21854 | 1 |
| 0.21855 | 1 |
| 0.21856 | 1 |
| 0.21857 | 1 |
| 0.21858 | 1 |
| 0.21859 | 1 |
| 0.2186 | 1 |
| 0.21861 | 1 |
| 0.21862 | 1 |
| 0.21863 | 1 |
| 0.21864 | 1 |
| 0.21865 | 1 |
| 0.21866 | 1 |
| 0.21867 | 1 |
| 0.21868 | 1 |
| 0.21869 | 1 |
| 0.2187 | 1 |
| 0.21871 | 1 |
| 0.21872 | 1 |
| 0.21873 | 1 |
| 0.21874 | 1 |
| 0.21875 | 1 |
| 0.21876 | 1 |
| 0.21877 | 1 |
| 0.21878 | 1 |
| 0.21879 | 1 |
| 0.2188 | 1 |
| 0.21881 | 1 |
| 0.21882 | 1 |
| 0.21883 | 1 |
| 0.21884 | 1 |
| 0.21885 | 1 |
| 0.21886 | 1 |
| 0.21887 | 1 |
| 0.21888 | 1 |
| 0.21889 | 1 |
| 0.2189 | 1 |
| 0.21891 | 1 |
| 0.21892 | 1 |
| 0.21893 | 1 |
| 0.21894 | 1 |
| 0.21895 | 1 |
| 0.21896 | 1 |
| 0.21897 | 1 |
| 0.21898 | 1 |
| 0.21899 | 1 |
| 0.219 | 1 |
| 0.21901 | 1 |
| 0.21902 | 1 |
| 0.21903 | 1 |
| 0.21904 | 1 |
| 0.21905 | 1 |
| 0.21906 | 1 |
| 0.21907 | 1 |
| 0.21908 | 1 |
| 0.21909 | 1 |
| 0.2191 | 1 |
| 0.21911 | 1 |
| 0.21912 | 1 |
| 0.21913 | 1 |
| 0.21914 | 1 |
| 0.21915 | 1 |
| 0.21916 | 1 |
| 0.21917 | 1 |
| 0.21918 | 1 |
| 0.21919 | 1 |
| 0.2192 | 1 |
| 0.21921 | 1 |
| 0.21922 | 1 |
| 0.21923 | 1 |
| 0.21924 | 1 |
| 0.21925 | 1 |
| 0.21926 | 1 |
| 0.21927 | 1 |
| 0.21928 | 1 |
| 0.21929 | 1 |
| 0.2193 | 1 |
| 0.21931 | 1 |
| 0.21932 | 1 |
| 0.21933 | 1 |
| 0.21934 | 1 |
| 0.21935 | 1 |
| 0.21936 | 1 |
| 0.21937 | 1 |
| 0.21938 | 1 |
| 0.21939 | 1 |
| 0.2194 | 1 |
| 0.21941 | 1 |
| 0.21942 | 1 |
| 0.21943 | 1 |
| 0.21944 | 1 |
| 0.21945 | 1 |
| 0.21946 | 1 |
| 0.21947 | 1 |
| 0.21948 | 1 |
| 0.21949 | 1 |
| 0.2195 | 1 |
| 0.21951 | 1 |
| 0.21952 | 1 |
| 0.21953 | 1 |
| 0.21954 | 1 |
| 0.21955 | 1 |
| 0.21956 | 1 |
| 0.21957 | 1 |
| 0.21958 | 1 |
| 0.21959 | 1 |
| 0.2196 | 1 |
| 0.21961 | 1 |
| 0.21962 | 1 |
| 0.21963 | 1 |
| 0.21964 | 1 |
| 0.21965 | 1 |
| 0.21966 | 1 |
| 0.21967 | 1 |
| 0.21968 | 1 |
| 0.21969 | 1 |
| 0.2197 | 1 |
| 0.21971 | 1 |
| 0.21972 | 1 |
| 0.21973 | 1 |
| 0.21974 | 1 |
| 0.21975 | 1 |
| 0.21976 | 1 |
| 0.21977 | 1 |
| 0.21978 | 1 |
| 0.21979 | 1 |
| 0.2198 | 1 |
| 0.21981 | 1 |
| 0.21982 | 1 |
| 0.21983 | 1 |
| 0.21984 | 1 |
| 0.21985 | 1 |
| 0.21986 | 1 |
| 0.21987 | 1 |
| 0.21988 | 1 |
| 0.21989 | 1 |
| 0.2199 | 1 |
| 0.21991 | 1 |
| 0.21992 | 1 |
| 0.21993 | 1 |
| 0.21994 | 1 |
| 0.21995 | 1 |
| 0.21996 | 1 |
| 0.21997 | 1 |
| 0.21998 | 1 |
| 0.21999 | 1 |
| 0.22 | 1 |
| 0.22001 | 1 |
| 0.22002 | 1 |
| 0.22003 | 1 |
| 0.22004 | 1 |
| 0.22005 | 1 |
| 0.22006 | 1 |
| 0.22007 | 1 |
| 0.22008 | 1 |
| 0.22009 | 1 |
| 0.2201 | 1 |
| 0.22011 | 1 |
| 0.22012 | 1 |
| 0.22013 | 1 |
| 0.22014 | 1 |
| 0.22015 | 1 |
| 0.22016 | 1 |
| 0.22017 | 1 |
| 0.22018 | 1 |
| 0.22019 | 1 |
| 0.2202 | 1 |
| 0.22021 | 1 |
| 0.22022 | 1 |
| 0.22023 | 1 |
| 0.22024 | 1 |
| 0.22025 | 1 |
| 0.22026 | 1 |
| 0.22027 | 1 |
| 0.22028 | 1 |
| 0.22029 | 1 |
| 0.2203 | 1 |
| 0.22031 | 1 |
| 0.22032 | 1 |
| 0.22033 | 1 |
| 0.22034 | 1 |
| 0.22035 | 1 |
| 0.22036 | 1 |
| 0.22037 | 1 |
| 0.22038 | 1 |
| 0.22039 | 1 |
| 0.2204 | 1 |
| 0.22041 | 1 |
| 0.22042 | 1 |
| 0.22043 | 1 |
| 0.22044 | 1 |
| 0.22045 | 1 |
| 0.22046 | 1 |
| 0.22047 | 1 |
| 0.22048 | 1 |
| 0.22049 | 1 |
| 0.2205 | 1 |
| 0.22051 | 1 |
| 0.22052 | 1 |
| 0.22053 | 1 |
| 0.22054 | 1 |
| 0.22055 | 1 |
| 0.22056 | 1 |
| 0.22057 | 1 |
| 0.22058 | 1 |
| 0.22059 | 1 |
| 0.2206 | 1 |
| 0.22061 | 1 |
| 0.22062 | 1 |
| 0.22063 | 1 |
| 0.22064 | 1 |
| 0.22065 | 1 |
| 0.22066 | 1 |
| 0.22067 | 1 |
| 0.22068 | 1 |
| 0.22069 | 1 |
| 0.2207 | 1 |
| 0.22071 | 1 |
| 0.22072 | 1 |
| 0.22073 | 1 |
| 0.22074 | 1 |
| 0.22075 | 1 |
| 0.22076 | 1 |
| 0.22077 | 1 |
| 0.22078 | 1 |
| 0.22079 | 1 |
| 0.2208 | 1 |
| 0.22081 | 1 |
| 0.22082 | 1 |
| 0.22083 | 1 |
| 0.22084 | 1 |
| 0.22085 | 1 |
| 0.22086 | 1 |
| 0.22087 | 1 |
| 0.22088 | 1 |
| 0.22089 | 1 |
| 0.2209 | 1 |
| 0.22091 | 1 |
| 0.22092 | 1 |
| 0.22093 | 1 |
| 0.22094 | 1 |
| 0.22095 | 1 |
| 0.22096 | 1 |
| 0.22097 | 1 |
| 0.22098 | 1 |
| 0.22099 | 1 |
| 0.221 | 1 |
| 0.22101 | 1 |
| 0.22102 | 1 |
| 0.22103 | 1 |
| 0.22104 | 1 |
| 0.22105 | 1 |
| 0.22106 | 1 |
| 0.22107 | 1 |
| 0.22108 | 1 |
| 0.22109 | 1 |
| 0.2211 | 1 |
| 0.22111 | 1 |
| 0.22112 | 1 |
| 0.22113 | 1 |
| 0.22114 | 1 |
| 0.22115 | 1 |
| 0.22116 | 1 |
| 0.22117 | 1 |
| 0.22118 | 1 |
| 0.22119 | 1 |
| 0.2212 | 1 |
| 0.22121 | 1 |
| 0.22122 | 1 |
| 0.22123 | 1 |
| 0.22124 | 1 |
| 0.22125 | 1 |
| 0.22126 | 1 |
| 0.22127 | 1 |
| 0.22128 | 1 |
| 0.22129 | 1 |
| 0.2213 | 1 |
| 0.22131 | 1 |
| 0.22132 | 1 |
| 0.22133 | 1 |
| 0.22134 | 1 |
| 0.22135 | 1 |
| 0.22136 | 1 |
| 0.22137 | 1 |
| 0.22138 | 1 |
| 0.22139 | 1 |
| 0.2214 | 1 |
| 0.22141 | 1 |
| 0.22142 | 1 |
| 0.22143 | 1 |
| 0.22144 | 1 |
| 0.22145 | 1 |
| 0.22146 | 1 |
| 0.22147 | 1 |
| 0.22148 | 1 |
| 0.22149 | 1 |
| 0.2215 | 1 |
| 0.22151 | 1 |
| 0.22152 | 1 |
| 0.22153 | 1 |
| 0.22154 | 1 |
| 0.22155 | 1 |
| 0.22156 | 1 |
| 0.22157 | 1 |
| 0.22158 | 1 |
| 0.22159 | 1 |
| 0.2216 | 1 |
| 0.22161 | 1 |
| 0.22162 | 1 |
| 0.22163 | 1 |
| 0.22164 | 1 |
| 0.22165 | 1 |
| 0.22166 | 1 |
| 0.22167 | 1 |
| 0.22168 | 1 |
| 0.22169 | 1 |
| 0.2217 | 1 |
| 0.22171 | 1 |
| 0.22172 | 1 |
| 0.22173 | 1 |
| 0.22174 | 1 |
| 0.22175 | 1 |
| 0.22176 | 1 |
| 0.22177 | 1 |
| 0.22178 | 1 |
| 0.22179 | 1 |
| 0.2218 | 1 |
| 0.22181 | 1 |
| 0.22182 | 1 |
| 0.22183 | 1 |
| 0.22184 | 1 |
| 0.22185 | 1 |
| 0.22186 | 1 |
| 0.22187 | 1 |
| 0.22188 | 1 |
| 0.22189 | 1 |
| 0.2219 | 1 |
| 0.22191 | 1 |
| 0.22192 | 1 |
| 0.22193 | 1 |
| 0.22194 | 1 |
| 0.22195 | 1 |
| 0.22196 | 1 |
| 0.22197 | 1 |
| 0.22198 | 1 |
| 0.22199 | 1 |
| 0.222 | 1 |
| 0.22201 | 1 |
| 0.22202 | 1 |
| 0.22203 | 1 |
| 0.22204 | 1 |
| 0.22205 | 1 |
| 0.22206 | 1 |
| 0.22207 | 1 |
| 0.22208 | 1 |
| 0.22209 | 1 |
| 0.2221 | 1 |
| 0.22211 | 1 |
| 0.22212 | 1 |
| 0.22213 | 1 |
| 0.22214 | 1 |
| 0.22215 | 1 |
| 0.22216 | 1 |
| 0.22217 | 1 |
| 0.22218 | 1 |
| 0.22219 | 1 |
| 0.2222 | 1 |
| 0.22221 | 1 |
| 0.22222 | 1 |
| 0.22223 | 1 |
| 0.22224 | 1 |
| 0.22225 | 1 |
| 0.22226 | 1 |
| 0.22227 | 1 |
| 0.22228 | 1 |
| 0.22229 | 1 |
| 0.2223 | 1 |
| 0.22231 | 1 |
| 0.22232 | 1 |
| 0.22233 | 1 |
| 0.22234 | 1 |
| 0.22235 | 1 |
| 0.22236 | 1 |
| 0.22237 | 1 |
| 0.22238 | 1 |
| 0.22239 | 1 |
| 0.2224 | 1 |
| 0.22241 | 1 |
| 0.22242 | 1 |
| 0.22243 | 1 |
| 0.22244 | 1 |
| 0.22245 | 1 |
| 0.22246 | 1 |
| 0.22247 | 1 |
| 0.22248 | 1 |
| 0.22249 | 1 |
| 0.2225 | 1 |
| 0.22251 | 1 |
| 0.22252 | 1 |
| 0.22253 | 1 |
| 0.22254 | 1 |
| 0.22255 | 1 |
| 0.22256 | 1 |
| 0.22257 | 1 |
| 0.22258 | 1 |
| 0.22259 | 1 |
| 0.2226 | 1 |
| 0.22261 | 1 |
| 0.22262 | 1 |
| 0.22263 | 1 |
| 0.22264 | 1 |
| 0.22265 | 1 |
| 0.22266 | 1 |
| 0.22267 | 1 |
| 0.22268 | 1 |
| 0.22269 | 1 |
| 0.2227 | 1 |
| 0.22271 | 1 |
| 0.22272 | 1 |
| 0.22273 | 1 |
| 0.22274 | 1 |
| 0.22275 | 1 |
| 0.22276 | 1 |
| 0.22277 | 1 |
| 0.22278 | 1 |
| 0.22279 | 1 |
| 0.2228 | 1 |
| 0.22281 | 1 |
| 0.22282 | 1 |
| 0.22283 | 1 |
| 0.22284 | 1 |
| 0.22285 | 1 |
| 0.22286 | 1 |
| 0.22287 | 1 |
| 0.22288 | 1 |
| 0.22289 | 1 |
| 0.2229 | 1 |
| 0.22291 | 1 |
| 0.22292 | 1 |
| 0.22293 | 1 |
| 0.22294 | 1 |
| 0.22295 | 1 |
| 0.22296 | 1 |
| 0.22297 | 1 |
| 0.22298 | 1 |
| 0.22299 | 1 |
| 0.223 | 1 |
| 0.22301 | 1 |
| 0.22302 | 1 |
| 0.22303 | 1 |
| 0.22304 | 1 |
| 0.22305 | 1 |
| 0.22306 | 1 |
| 0.22307 | 1 |
| 0.22308 | 1 |
| 0.22309 | 1 |
| 0.2231 | 1 |
| 0.22311 | 1 |
| 0.22312 | 1 |
| 0.22313 | 1 |
| 0.22314 | 1 |
| 0.22315 | 1 |
| 0.22316 | 1 |
| 0.22317 | 1 |
| 0.22318 | 1 |
| 0.22319 | 1 |
| 0.2232 | 1 |
| 0.22321 | 1 |
| 0.22322 | 1 |
| 0.22323 | 1 |
| 0.22324 | 1 |
| 0.22325 | 1 |
| 0.22326 | 1 |
| 0.22327 | 1 |
| 0.22328 | 1 |
| 0.22329 | 1 |
| 0.2233 | 1 |
| 0.22331 | 1 |
| 0.22332 | 1 |
| 0.22333 | 1 |
| 0.22334 | 1 |
| 0.22335 | 1 |
| 0.22336 | 1 |
| 0.22337 | 1 |
| 0.22338 | 1 |
| 0.22339 | 1 |
| 0.2234 | 1 |
| 0.22341 | 1 |
| 0.22342 | 1 |
| 0.22343 | 1 |
| 0.22344 | 1 |
| 0.22345 | 1 |
| 0.22346 | 1 |
| 0.22347 | 1 |
| 0.22348 | 1 |
| 0.22349 | 1 |
| 0.2235 | 1 |
| 0.22351 | 1 |
| 0.22352 | 1 |
| 0.22353 | 1 |
| 0.22354 | 1 |
| 0.22355 | 1 |
| 0.22356 | 1 |
| 0.22357 | 1 |
| 0.22358 | 1 |
| 0.22359 | 1 |
| 0.2236 | 1 |
| 0.22361 | 1 |
| 0.22362 | 1 |
| 0.22363 | 1 |
| 0.22364 | 1 |
| 0.22365 | 1 |
| 0.22366 | 1 |
| 0.22367 | 1 |
| 0.22368 | 1 |
| 0.22369 | 1 |
| 0.2237 | 1 |
| 0.22371 | 1 |
| 0.22372 | 1 |
| 0.22373 | 1 |
| 0.22374 | 1 |
| 0.22375 | 1 |
| 0.22376 | 1 |
| 0.22377 | 1 |
| 0.22378 | 1 |
| 0.22379 | 1 |
| 0.2238 | 1 |
| 0.22381 | 1 |
| 0.22382 | 1 |
| 0.22383 | 1 |
| 0.22384 | 1 |
| 0.22385 | 1 |
| 0.22386 | 1 |
| 0.22387 | 1 |
| 0.22388 | 1 |
| 0.22389 | 1 |
| 0.2239 | 1 |
| 0.22391 | 1 |
| 0.22392 | 1 |
| 0.22393 | 1 |
| 0.22394 | 1 |
| 0.22395 | 1 |
| 0.22396 | 1 |
| 0.22397 | 1 |
| 0.22398 | 1 |
| 0.22399 | 1 |
| 0.224 | 1 |
| 0.22401 | 1 |
| 0.22402 | 1 |
| 0.22403 | 1 |
| 0.22404 | 1 |
| 0.22405 | 1 |
| 0.22406 | 1 |
| 0.22407 | 1 |
| 0.22408 | 1 |
| 0.22409 | 1 |
| 0.2241 | 1 |
| 0.22411 | 1 |
| 0.22412 | 1 |
| 0.22413 | 1 |
| 0.22414 | 1 |
| 0.22415 | 1 |
| 0.22416 | 1 |
| 0.22417 | 1 |
| 0.22418 | 1 |
| 0.22419 | 1 |
| 0.2242 | 1 |
| 0.22421 | 1 |
| 0.22422 | 1 |
| 0.22423 | 1 |
| 0.22424 | 1 |
| 0.22425 | 1 |
| 0.22426 | 1 |
| 0.22427 | 1 |
| 0.22428 | 1 |
| 0.22429 | 1 |
| 0.2243 | 1 |
| 0.22431 | 1 |
| 0.22432 | 1 |
| 0.22433 | 1 |
| 0.22434 | 1 |
| 0.22435 | 1 |
| 0.22436 | 1 |
| 0.22437 | 1 |
| 0.22438 | 1 |
| 0.22439 | 1 |
| 0.2244 | 1 |
| 0.22441 | 1 |
| 0.22442 | 1 |
| 0.22443 | 1 |
| 0.22444 | 1 |
| 0.22445 | 1 |
| 0.22446 | 1 |
| 0.22447 | 1 |
| 0.22448 | 1 |
| 0.22449 | 1 |
| 0.2245 | 1 |
| 0.22451 | 1 |
| 0.22452 | 1 |
| 0.22453 | 1 |
| 0.22454 | 1 |
| 0.22455 | 1 |
| 0.22456 | 1 |
| 0.22457 | 1 |
| 0.22458 | 1 |
| 0.22459 | 1 |
| 0.2246 | 1 |
| 0.22461 | 1 |
| 0.22462 | 1 |
| 0.22463 | 1 |
| 0.22464 | 1 |
| 0.22465 | 1 |
| 0.22466 | 1 |
| 0.22467 | 1 |
| 0.22468 | 1 |
| 0.22469 | 1 |
| 0.2247 | 1 |
| 0.22471 | 1 |
| 0.22472 | 1 |
| 0.22473 | 1 |
| 0.22474 | 1 |
| 0.22475 | 1 |
| 0.22476 | 1 |
| 0.22477 | 1 |
| 0.22478 | 1 |
| 0.22479 | 1 |
| 0.2248 | 1 |
| 0.22481 | 1 |
| 0.22482 | 1 |
| 0.22483 | 1 |
| 0.22484 | 1 |
| 0.22485 | 1 |
| 0.22486 | 1 |
| 0.22487 | 1 |
| 0.22488 | 1 |
| 0.22489 | 1 |
| 0.2249 | 1 |
| 0.22491 | 1 |
| 0.22492 | 1 |
| 0.22493 | 0.999 |
| 0.22494 | 0.999 |
| 0.22495 | 0.999 |
| 0.22496 | 0.999 |
| 0.22497 | 0.999 |
| 0.22498 | 0.999 |
| 0.22499 | 0.999 |
| 0.225 | 0.999 |
| 0.22501 | 0.999 |
| 0.22502 | 0.999 |
| 0.22503 | 0.999 |
| 0.22504 | 0.999 |
| 0.22505 | 0.999 |
| 0.22506 | 0.999 |
| 0.22507 | 0.999 |
| 0.22508 | 0.999 |
| 0.22509 | 0.999 |
| 0.2251 | 0.999 |
| 0.22511 | 0.999 |
| 0.22512 | 0.999 |
| 0.22513 | 0.999 |
| 0.22514 | 0.999 |
| 0.22515 | 0.999 |
| 0.22516 | 0.999 |
| 0.22517 | 0.999 |
| 0.22518 | 0.999 |
| 0.22519 | 0.999 |
| 0.2252 | 0.999 |
| 0.22521 | 0.999 |
| 0.22522 | 0.999 |
| 0.22523 | 0.999 |
| 0.22524 | 0.999 |
| 0.22525 | 0.999 |
| 0.22526 | 0.999 |
| 0.22527 | 0.999 |
| 0.22528 | 0.999 |
| 0.22529 | 0.999 |
| 0.2253 | 0.999 |
| 0.22531 | 0.999 |
| 0.22532 | 0.999 |
| 0.22533 | 0.999 |
| 0.22534 | 0.999 |
| 0.22535 | 0.999 |
| 0.22536 | 0.999 |
| 0.22537 | 0.999 |
| 0.22538 | 0.999 |
| 0.22539 | 0.999 |
| 0.2254 | 0.999 |
| 0.22541 | 0.999 |
| 0.22542 | 0.999 |
| 0.22543 | 0.999 |
| 0.22544 | 0.999 |
| 0.22545 | 0.999 |
| 0.22546 | 0.999 |
| 0.22547 | 0.999 |
| 0.22548 | 0.999 |
| 0.22549 | 0.999 |
| 0.2255 | 0.999 |
| 0.22551 | 0.999 |
| 0.22552 | 0.999 |
| 0.22553 | 0.999 |
| 0.22554 | 0.999 |
| 0.22555 | 0.999 |
| 0.22556 | 0.999 |
| 0.22557 | 0.999 |
| 0.22558 | 0.999 |
| 0.22559 | 0.999 |
| 0.2256 | 0.999 |
| 0.22561 | 0.999 |
| 0.22562 | 0.999 |
| 0.22563 | 0.999 |
| 0.22564 | 0.999 |
| 0.22565 | 0.999 |
| 0.22566 | 0.999 |
| 0.22567 | 0.999 |
| 0.22568 | 0.999 |
| 0.22569 | 0.999 |
| 0.2257 | 0.999 |
| 0.22571 | 0.999 |
| 0.22572 | 0.999 |
| 0.22573 | 0.999 |
| 0.22574 | 0.999 |
| 0.22575 | 0.999 |
| 0.22576 | 0.999 |
| 0.22577 | 0.999 |
| 0.22578 | 0.999 |
| 0.22579 | 0.999 |
| 0.2258 | 0.999 |
| 0.22581 | 0.999 |
| 0.22582 | 0.999 |
| 0.22583 | 0.999 |
| 0.22584 | 0.999 |
| 0.22585 | 0.999 |
| 0.22586 | 0.999 |
| 0.22587 | 0.999 |
| 0.22588 | 0.999 |
| 0.22589 | 0.999 |
| 0.2259 | 0.999 |
| 0.22591 | 0.999 |
| 0.22592 | 0.999 |
| 0.22593 | 0.999 |
| 0.22594 | 0.999 |
| 0.22595 | 0.999 |
| 0.22596 | 0.999 |
| 0.22597 | 0.999 |
| 0.22598 | 0.999 |
| 0.22599 | 0.999 |
| 0.226 | 0.999 |
| 0.22601 | 0.999 |
| 0.22602 | 0.999 |
| 0.22603 | 0.999 |
| 0.22604 | 0.999 |
| 0.22605 | 0.999 |
| 0.22606 | 0.999 |
| 0.22607 | 0.999 |
| 0.22608 | 0.999 |
| 0.22609 | 0.999 |
| 0.2261 | 0.999 |
| 0.22611 | 0.999 |
| 0.22612 | 0.999 |
| 0.22613 | 0.999 |
| 0.22614 | 0.999 |
| 0.22615 | 0.999 |
| 0.22616 | 0.999 |
| 0.22617 | 0.999 |
| 0.22618 | 0.999 |
| 0.22619 | 0.999 |
| 0.2262 | 0.999 |
| 0.22621 | 0.999 |
| 0.22622 | 0.999 |
| 0.22623 | 0.999 |
| 0.22624 | 0.999 |
| 0.22625 | 0.999 |
| 0.22626 | 0.999 |
| 0.22627 | 0.999 |
| 0.22628 | 0.999 |
| 0.22629 | 0.999 |
| 0.2263 | 0.999 |
| 0.22631 | 0.999 |
| 0.22632 | 0.999 |
| 0.22633 | 0.999 |
| 0.22634 | 0.999 |
| 0.22635 | 0.999 |
| 0.22636 | 0.999 |
| 0.22637 | 0.999 |
| 0.22638 | 0.999 |
| 0.22639 | 0.999 |
| 0.2264 | 0.999 |
| 0.22641 | 0.999 |
| 0.22642 | 0.999 |
| 0.22643 | 0.999 |
| 0.22644 | 0.999 |
| 0.22645 | 0.999 |
| 0.22646 | 0.999 |
| 0.22647 | 0.999 |
| 0.22648 | 0.999 |
| 0.22649 | 0.999 |
| 0.2265 | 0.999 |
| 0.22651 | 0.999 |
| 0.22652 | 0.999 |
| 0.22653 | 0.999 |
| 0.22654 | 0.999 |
| 0.22655 | 0.999 |
| 0.22656 | 0.999 |
| 0.22657 | 0.999 |
| 0.22658 | 0.999 |
| 0.22659 | 0.999 |
| 0.2266 | 0.999 |
| 0.22661 | 0.999 |
| 0.22662 | 0.999 |
| 0.22663 | 0.999 |
| 0.22664 | 0.999 |
| 0.22665 | 0.999 |
| 0.22666 | 0.999 |
| 0.22667 | 0.999 |
| 0.22668 | 0.999 |
| 0.22669 | 0.999 |
| 0.2267 | 0.999 |
| 0.22671 | 0.999 |
| 0.22672 | 0.999 |
| 0.22673 | 0.999 |
| 0.22674 | 0.999 |
| 0.22675 | 0.999 |
| 0.22676 | 0.999 |
| 0.22677 | 0.999 |
| 0.22678 | 0.999 |
| 0.22679 | 0.999 |
| 0.2268 | 0.999 |
| 0.22681 | 0.999 |
| 0.22682 | 0.999 |
| 0.22683 | 0.999 |
| 0.22684 | 0.999 |
| 0.22685 | 0.999 |
| 0.22686 | 0.999 |
| 0.22687 | 0.999 |
| 0.22688 | 0.999 |
| 0.22689 | 0.999 |
| 0.2269 | 0.999 |
| 0.22691 | 0.999 |
| 0.22692 | 0.999 |
| 0.22693 | 0.999 |
| 0.22694 | 0.999 |
| 0.22695 | 0.999 |
| 0.22696 | 0.999 |
| 0.22697 | 0.999 |
| 0.22698 | 0.999 |
| 0.22699 | 0.999 |
| 0.227 | 0.999 |
| 0.22701 | 0.999 |
| 0.22702 | 0.999 |
| 0.22703 | 0.999 |
| 0.22704 | 0.999 |
| 0.22705 | 0.999 |
| 0.22706 | 0.999 |
| 0.22707 | 0.999 |
| 0.22708 | 0.999 |
| 0.22709 | 0.999 |
| 0.2271 | 0.999 |
| 0.22711 | 0.999 |
| 0.22712 | 0.999 |
| 0.22713 | 0.999 |
| 0.22714 | 0.999 |
| 0.22715 | 0.999 |
| 0.22716 | 0.999 |
| 0.22717 | 0.999 |
| 0.22718 | 0.999 |
| 0.22719 | 0.999 |
| 0.2272 | 0.999 |
| 0.22721 | 0.999 |
| 0.22722 | 0.999 |
| 0.22723 | 0.999 |
| 0.22724 | 0.999 |
| 0.22725 | 0.999 |
| 0.22726 | 0.999 |
| 0.22727 | 0.999 |
| 0.22728 | 0.999 |
| 0.22729 | 0.999 |
| 0.2273 | 0.999 |
| 0.22731 | 0.999 |
| 0.22732 | 0.999 |
| 0.22733 | 0.999 |
| 0.22734 | 0.999 |
| 0.22735 | 0.999 |
| 0.22736 | 0.999 |
| 0.22737 | 0.999 |
| 0.22738 | 0.999 |
| 0.22739 | 0.999 |
| 0.2274 | 0.999 |
| 0.22741 | 0.999 |
| 0.22742 | 0.999 |
| 0.22743 | 0.999 |
| 0.22744 | 0.999 |
| 0.22745 | 0.999 |
| 0.22746 | 0.999 |
| 0.22747 | 0.999 |
| 0.22748 | 0.999 |
| 0.22749 | 0.999 |
| 0.2275 | 0.999 |
| 0.22751 | 0.999 |
| 0.22752 | 0.999 |
| 0.22753 | 0.999 |
| 0.22754 | 0.999 |
| 0.22755 | 0.999 |
| 0.22756 | 0.999 |
| 0.22757 | 0.999 |
| 0.22758 | 0.999 |
| 0.22759 | 0.999 |
| 0.2276 | 0.999 |
| 0.22761 | 0.999 |
| 0.22762 | 0.999 |
| 0.22763 | 0.999 |
| 0.22764 | 0.999 |
| 0.22765 | 0.999 |
| 0.22766 | 0.999 |
| 0.22767 | 0.999 |
| 0.22768 | 0.999 |
| 0.22769 | 0.999 |
| 0.2277 | 0.999 |
| 0.22771 | 0.999 |
| 0.22772 | 0.999 |
| 0.22773 | 0.999 |
| 0.22774 | 0.999 |
| 0.22775 | 0.999 |
| 0.22776 | 0.999 |
| 0.22777 | 0.999 |
| 0.22778 | 0.999 |
| 0.22779 | 0.999 |
| 0.2278 | 0.999 |
| 0.22781 | 0.999 |
| 0.22782 | 0.999 |
| 0.22783 | 0.999 |
| 0.22784 | 0.999 |
| 0.22785 | 0.999 |
| 0.22786 | 0.999 |
| 0.22787 | 0.999 |
| 0.22788 | 1 |
| 0.22789 | 1 |
| 0.2279 | 1 |
| 0.22791 | 1 |
| 0.22792 | 1 |
| 0.22793 | 1 |
| 0.22794 | 1 |
| 0.22795 | 1 |
| 0.22796 | 1 |
| 0.22797 | 1 |
| 0.22798 | 1 |
| 0.22799 | 1 |
| 0.228 | 1 |
| 0.22801 | 1 |
| 0.22802 | 1 |
| 0.22803 | 1 |
| 0.22804 | 1 |
| 0.22805 | 1 |
| 0.22806 | 1 |
| 0.22807 | 1 |
| 0.22808 | 1 |
| 0.22809 | 1 |
| 0.2281 | 1 |
| 0.22811 | 1 |
| 0.22812 | 1 |
| 0.22813 | 1 |
| 0.22814 | 1 |
| 0.22815 | 1 |
| 0.22816 | 1 |
| 0.22817 | 1 |
| 0.22818 | 1 |
| 0.22819 | 1 |
| 0.2282 | 1 |
| 0.22821 | 1 |
| 0.22822 | 1 |
| 0.22823 | 1 |
| 0.22824 | 1 |
| 0.22825 | 1 |
| 0.22826 | 1 |
| 0.22827 | 1 |
| 0.22828 | 1 |
| 0.22829 | 1 |
| 0.2283 | 1 |
| 0.22831 | 1 |
| 0.22832 | 1 |
| 0.22833 | 1 |
| 0.22834 | 1 |
| 0.22835 | 1 |
| 0.22836 | 1 |
| 0.22837 | 1 |
| 0.22838 | 1 |
| 0.22839 | 1 |
| 0.2284 | 1 |
| 0.22841 | 1 |
| 0.22842 | 1 |
| 0.22843 | 1 |
| 0.22844 | 1 |
| 0.22845 | 1 |
| 0.22846 | 1 |
| 0.22847 | 1 |
| 0.22848 | 1 |
| 0.22849 | 1 |
| 0.2285 | 1 |
| 0.22851 | 1 |
| 0.22852 | 1 |
| 0.22853 | 1 |
| 0.22854 | 1 |
| 0.22855 | 1 |
| 0.22856 | 1 |
| 0.22857 | 1 |
| 0.22858 | 1 |
| 0.22859 | 1 |
| 0.2286 | 1 |
| 0.22861 | 0.999 |
| 0.22862 | 0.999 |
| 0.22863 | 0.999 |
| 0.22864 | 0.999 |
| 0.22865 | 0.999 |
| 0.22866 | 0.999 |
| 0.22867 | 0.999 |
| 0.22868 | 0.999 |
| 0.22869 | 0.999 |
| 0.2287 | 0.999 |
| 0.22871 | 0.999 |
| 0.22872 | 0.999 |
| 0.22873 | 0.999 |
| 0.22874 | 0.999 |
| 0.22875 | 0.999 |
| 0.22876 | 0.999 |
| 0.22877 | 0.999 |
| 0.22878 | 0.999 |
| 0.22879 | 0.999 |
| 0.2288 | 0.999 |
| 0.22881 | 0.999 |
| 0.22882 | 0.999 |
| 0.22883 | 0.999 |
| 0.22884 | 0.999 |
| 0.22885 | 0.999 |
| 0.22886 | 0.999 |
| 0.22887 | 0.999 |
| 0.22888 | 0.999 |
| 0.22889 | 0.999 |
| 0.2289 | 0.999 |
| 0.22891 | 0.999 |
| 0.22892 | 0.999 |
| 0.22893 | 0.999 |
| 0.22894 | 0.999 |
| 0.22895 | 0.999 |
| 0.22896 | 0.999 |
| 0.22897 | 0.999 |
| 0.22898 | 0.999 |
| 0.22899 | 0.999 |
| 0.229 | 0.999 |
| 0.22901 | 0.999 |
| 0.22902 | 0.999 |
| 0.22903 | 0.999 |
| 0.22904 | 0.999 |
| 0.22905 | 0.999 |
| 0.22906 | 0.999 |
| 0.22907 | 0.999 |
| 0.22908 | 0.999 |
| 0.22909 | 0.999 |
| 0.2291 | 0.999 |
| 0.22911 | 0.999 |
| 0.22912 | 0.999 |
| 0.22913 | 0.999 |
| 0.22914 | 0.999 |
| 0.22915 | 0.999 |
| 0.22916 | 0.999 |
| 0.22917 | 0.999 |
| 0.22918 | 0.999 |
| 0.22919 | 0.999 |
| 0.2292 | 0.999 |
| 0.22921 | 0.999 |
| 0.22922 | 0.999 |
| 0.22923 | 0.999 |
| 0.22924 | 0.999 |
| 0.22925 | 0.999 |
| 0.22926 | 0.999 |
| 0.22927 | 0.999 |
| 0.22928 | 0.999 |
| 0.22929 | 0.999 |
| 0.2293 | 0.999 |
| 0.22931 | 0.999 |
| 0.22932 | 0.999 |
| 0.22933 | 0.999 |
| 0.22934 | 0.999 |
| 0.22935 | 0.999 |
| 0.22936 | 0.999 |
| 0.22937 | 0.999 |
| 0.22938 | 0.999 |
| 0.22939 | 0.999 |
| 0.2294 | 0.999 |
| 0.22941 | 0.999 |
| 0.22942 | 0.999 |
| 0.22943 | 0.999 |
| 0.22944 | 0.999 |
| 0.22945 | 0.999 |
| 0.22946 | 0.999 |
| 0.22947 | 0.999 |
| 0.22948 | 0.999 |
| 0.22949 | 0.999 |
| 0.2295 | 0.999 |
| 0.22951 | 0.999 |
| 0.22952 | 0.999 |
| 0.22953 | 0.999 |
| 0.22954 | 0.999 |
| 0.22955 | 0.999 |
| 0.22956 | 0.999 |
| 0.22957 | 0.999 |
| 0.22958 | 0.999 |
| 0.22959 | 0.999 |
| 0.2296 | 0.999 |
| 0.22961 | 0.999 |
| 0.22962 | 0.999 |
| 0.22963 | 0.999 |
| 0.22964 | 0.999 |
| 0.22965 | 0.999 |
| 0.22966 | 0.999 |
| 0.22967 | 0.999 |
| 0.22968 | 0.999 |
| 0.22969 | 0.999 |
| 0.2297 | 0.999 |
| 0.22971 | 0.999 |
| 0.22972 | 0.999 |
| 0.22973 | 0.999 |
| 0.22974 | 0.999 |
| 0.22975 | 0.999 |
| 0.22976 | 0.999 |
| 0.22977 | 0.999 |
| 0.22978 | 0.999 |
| 0.22979 | 0.999 |
| 0.2298 | 0.999 |
| 0.22981 | 0.999 |
| 0.22982 | 0.999 |
| 0.22983 | 0.999 |
| 0.22984 | 0.999 |
| 0.22985 | 0.999 |
| 0.22986 | 0.999 |
| 0.22987 | 0.999 |
| 0.22988 | 0.999 |
| 0.22989 | 0.999 |
| 0.2299 | 0.999 |
| 0.22991 | 0.999 |
| 0.22992 | 0.999 |
| 0.22993 | 0.999 |
| 0.22994 | 0.999 |
| 0.22995 | 0.999 |
| 0.22996 | 0.999 |
| 0.22997 | 0.999 |
| 0.22998 | 0.999 |
| 0.22999 | 0.999 |
| 0.23 | 0.999 |
| 0.23001 | 0.999 |
| 0.23002 | 0.999 |
| 0.23003 | 0.999 |
| 0.23004 | 0.999 |
| 0.23005 | 0.999 |
| 0.23006 | 0.999 |
| 0.23007 | 0.999 |
| 0.23008 | 0.999 |
| 0.23009 | 0.999 |
| 0.2301 | 0.999 |
| 0.23011 | 0.999 |
| 0.23012 | 0.999 |
| 0.23013 | 0.999 |
| 0.23014 | 0.999 |
| 0.23015 | 0.999 |
| 0.23016 | 0.999 |
| 0.23017 | 0.999 |
| 0.23018 | 0.999 |
| 0.23019 | 0.999 |
| 0.2302 | 0.999 |
| 0.23021 | 0.999 |
| 0.23022 | 0.999 |
| 0.23023 | 0.999 |
| 0.23024 | 0.999 |
| 0.23025 | 0.999 |
| 0.23026 | 0.999 |
| 0.23027 | 0.999 |
| 0.23028 | 0.999 |
| 0.23029 | 0.999 |
| 0.2303 | 0.999 |
| 0.23031 | 0.999 |
| 0.23032 | 0.999 |
| 0.23033 | 0.999 |
| 0.23034 | 0.999 |
| 0.23035 | 0.999 |
| 0.23036 | 0.999 |
| 0.23037 | 0.999 |
| 0.23038 | 0.999 |
| 0.23039 | 0.999 |
| 0.2304 | 0.999 |
| 0.23041 | 0.999 |
| 0.23042 | 0.999 |
| 0.23043 | 0.999 |
| 0.23044 | 0.999 |
| 0.23045 | 0.999 |
| 0.23046 | 0.999 |
| 0.23047 | 0.999 |
| 0.23048 | 0.999 |
| 0.23049 | 0.999 |
| 0.2305 | 0.999 |
| 0.23051 | 0.999 |
| 0.23052 | 0.999 |
| 0.23053 | 0.999 |
| 0.23054 | 0.999 |
| 0.23055 | 0.999 |
| 0.23056 | 0.999 |
| 0.23057 | 0.999 |
| 0.23058 | 0.999 |
| 0.23059 | 0.999 |
| 0.2306 | 0.999 |
| 0.23061 | 0.999 |
| 0.23062 | 0.999 |
| 0.23063 | 0.999 |
| 0.23064 | 0.999 |
| 0.23065 | 0.999 |
| 0.23066 | 0.999 |
| 0.23067 | 0.999 |
| 0.23068 | 0.999 |
| 0.23069 | 0.999 |
| 0.2307 | 0.999 |
| 0.23071 | 0.999 |
| 0.23072 | 0.999 |
| 0.23073 | 0.999 |
| 0.23074 | 0.999 |
| 0.23075 | 0.999 |
| 0.23076 | 0.999 |
| 0.23077 | 0.999 |
| 0.23078 | 0.999 |
| 0.23079 | 0.999 |
| 0.2308 | 0.999 |
| 0.23081 | 0.999 |
| 0.23082 | 0.999 |
| 0.23083 | 0.999 |
| 0.23084 | 0.999 |
| 0.23085 | 0.999 |
| 0.23086 | 0.999 |
| 0.23087 | 0.999 |
| 0.23088 | 0.999 |
| 0.23089 | 0.999 |
| 0.2309 | 0.999 |
| 0.23091 | 0.999 |
| 0.23092 | 0.999 |
| 0.23093 | 0.999 |
| 0.23094 | 0.999 |
| 0.23095 | 0.999 |
| 0.23096 | 0.999 |
| 0.23097 | 0.999 |
| 0.23098 | 0.999 |
| 0.23099 | 0.999 |
| 0.231 | 0.999 |
| 0.23101 | 0.999 |
| 0.23102 | 0.999 |
| 0.23103 | 0.999 |
| 0.23104 | 0.999 |
| 0.23105 | 0.999 |
| 0.23106 | 0.999 |
| 0.23107 | 0.999 |
| 0.23108 | 0.999 |
| 0.23109 | 0.999 |
| 0.2311 | 0.999 |
| 0.23111 | 0.999 |
| 0.23112 | 0.999 |
| 0.23113 | 0.999 |
| 0.23114 | 0.999 |
| 0.23115 | 0.999 |
| 0.23116 | 0.999 |
| 0.23117 | 0.999 |
| 0.23118 | 0.999 |
| 0.23119 | 0.999 |
| 0.2312 | 0.999 |
| 0.23121 | 0.999 |
| 0.23122 | 0.999 |
| 0.23123 | 0.999 |
| 0.23124 | 0.999 |
| 0.23125 | 0.999 |
| 0.23126 | 0.999 |
| 0.23127 | 0.999 |
| 0.23128 | 0.999 |
| 0.23129 | 0.999 |
| 0.2313 | 0.999 |
| 0.23131 | 0.999 |
| 0.23132 | 0.999 |
| 0.23133 | 0.999 |
| 0.23134 | 0.999 |
| 0.23135 | 0.999 |
| 0.23136 | 0.999 |
| 0.23137 | 0.999 |
| 0.23138 | 0.999 |
| 0.23139 | 0.999 |
| 0.2314 | 0.999 |
| 0.23141 | 0.999 |
| 0.23142 | 0.999 |
| 0.23143 | 0.999 |
| 0.23144 | 0.999 |
| 0.23145 | 0.999 |
| 0.23146 | 0.999 |
| 0.23147 | 0.999 |
| 0.23148 | 0.999 |
| 0.23149 | 0.999 |
| 0.2315 | 0.999 |
| 0.23151 | 0.999 |
| 0.23152 | 0.999 |
| 0.23153 | 0.999 |
| 0.23154 | 0.999 |
| 0.23155 | 0.999 |
| 0.23156 | 0.999 |
| 0.23157 | 0.999 |
| 0.23158 | 0.999 |
| 0.23159 | 0.999 |
| 0.2316 | 0.999 |
| 0.23161 | 0.999 |
| 0.23162 | 0.999 |
| 0.23163 | 0.999 |
| 0.23164 | 0.999 |
| 0.23165 | 0.999 |
| 0.23166 | 0.999 |
| 0.23167 | 0.999 |
| 0.23168 | 0.999 |
| 0.23169 | 0.999 |
| 0.2317 | 0.999 |
| 0.23171 | 0.999 |
| 0.23172 | 0.999 |
| 0.23173 | 0.999 |
| 0.23174 | 0.999 |
| 0.23175 | 0.999 |
| 0.23176 | 0.999 |
| 0.23177 | 0.999 |
| 0.23178 | 0.999 |
| 0.23179 | 0.999 |
| 0.2318 | 0.999 |
| 0.23181 | 1 |
| 0.23182 | 1 |
| 0.23183 | 1 |
| 0.23184 | 1 |
| 0.23185 | 1 |
| 0.23186 | 1 |
| 0.23187 | 1 |
| 0.23188 | 1 |
| 0.23189 | 1 |
| 0.2319 | 1 |
| 0.23191 | 1 |
| 0.23192 | 1 |
| 0.23193 | 1 |
| 0.23194 | 1 |
| 0.23195 | 1 |
| 0.23196 | 1 |
| 0.23197 | 1 |
| 0.23198 | 1 |
| 0.23199 | 1 |
| 0.232 | 1 |
| 0.23201 | 1 |
| 0.23202 | 1 |
| 0.23203 | 1 |
| 0.23204 | 1 |
| 0.23205 | 1 |
| 0.23206 | 1 |
| 0.23207 | 1 |
| 0.23208 | 1 |
| 0.23209 | 1 |
| 0.2321 | 1 |
| 0.23211 | 1 |
| 0.23212 | 1 |
| 0.23213 | 1 |
| 0.23214 | 1 |
| 0.23215 | 1 |
| 0.23216 | 1 |
| 0.23217 | 1 |
| 0.23218 | 1 |
| 0.23219 | 1 |
| 0.2322 | 1 |
| 0.23221 | 1 |
| 0.23222 | 1 |
| 0.23223 | 1 |
| 0.23224 | 1 |
| 0.23225 | 1 |
| 0.23226 | 1 |
| 0.23227 | 1 |
| 0.23228 | 1 |
| 0.23229 | 1 |
| 0.2323 | 1 |
| 0.23231 | 1 |
| 0.23232 | 1 |
| 0.23233 | 1 |
| 0.23234 | 1 |
| 0.23235 | 1 |
| 0.23236 | 1 |
| 0.23237 | 1 |
| 0.23238 | 1 |
| 0.23239 | 1 |
| 0.2324 | 1 |
| 0.23241 | 1 |
| 0.23242 | 1 |
| 0.23243 | 1 |
| 0.23244 | 1 |
| 0.23245 | 1 |
| 0.23246 | 1 |
| 0.23247 | 1 |
| 0.23248 | 1 |
| 0.23249 | 1 |
| 0.2325 | 1 |
| 0.23251 | 1 |
| 0.23252 | 1 |
| 0.23253 | 1 |
| 0.23254 | 1 |
| 0.23255 | 1 |
| 0.23256 | 1 |
| 0.23257 | 1 |
| 0.23258 | 1 |
| 0.23259 | 1 |
| 0.2326 | 1 |
| 0.23261 | 1 |
| 0.23262 | 1 |
| 0.23263 | 1 |
| 0.23264 | 1 |
| 0.23265 | 1 |
| 0.23266 | 1 |
| 0.23267 | 1 |
| 0.23268 | 1 |
| 0.23269 | 1 |
| 0.2327 | 1 |
| 0.23271 | 1 |
| 0.23272 | 1 |
| 0.23273 | 1 |
| 0.23274 | 1 |
| 0.23275 | 1 |
| 0.23276 | 1 |
| 0.23277 | 1 |
| 0.23278 | 1 |
| 0.23279 | 1 |
| 0.2328 | 1 |
| 0.23281 | 1 |
| 0.23282 | 1 |
| 0.23283 | 1 |
| 0.23284 | 1 |
| 0.23285 | 1 |
| 0.23286 | 1 |
| 0.23287 | 1 |
| 0.23288 | 1 |
| 0.23289 | 1 |
| 0.2329 | 1 |
| 0.23291 | 1 |
| 0.23292 | 1 |
| 0.23293 | 1 |
| 0.23294 | 1 |
| 0.23295 | 1 |
| 0.23296 | 1 |
| 0.23297 | 1 |
| 0.23298 | 1 |
| 0.23299 | 1 |
| 0.233 | 1 |
| 0.23301 | 1 |
| 0.23302 | 1 |
| 0.23303 | 1 |
| 0.23304 | 1 |
| 0.23305 | 1 |
| 0.23306 | 1 |
| 0.23307 | 1 |
| 0.23308 | 1 |
| 0.23309 | 1 |
| 0.2331 | 1 |
| 0.23311 | 1 |
| 0.23312 | 1 |
| 0.23313 | 1 |
| 0.23314 | 1 |
| 0.23315 | 1 |
| 0.23316 | 1 |
| 0.23317 | 1 |
| 0.23318 | 1 |
| 0.23319 | 1 |
| 0.2332 | 1 |
| 0.23321 | 1 |
| 0.23322 | 1 |
| 0.23323 | 1 |
| 0.23324 | 1 |
| 0.23325 | 1 |
| 0.23326 | 1 |
| 0.23327 | 1 |
| 0.23328 | 1 |
| 0.23329 | 1 |
| 0.2333 | 1 |
| 0.23331 | 1 |
| 0.23332 | 1 |
| 0.23333 | 1 |
| 0.23334 | 1 |
| 0.23335 | 1 |
| 0.23336 | 1 |
| 0.23337 | 1 |
| 0.23338 | 1 |
| 0.23339 | 1 |
| 0.2334 | 1 |
| 0.23341 | 1 |
| 0.23342 | 1 |
| 0.23343 | 1 |
| 0.23344 | 1 |
| 0.23345 | 1 |
| 0.23346 | 1 |
| 0.23347 | 1 |
| 0.23348 | 1 |
| 0.23349 | 1 |
| 0.2335 | 1 |
| 0.23351 | 1 |
| 0.23352 | 1 |
| 0.23353 | 1 |
| 0.23354 | 1 |
| 0.23355 | 1 |
| 0.23356 | 1 |
| 0.23357 | 1 |
| 0.23358 | 1 |
| 0.23359 | 1 |
| 0.2336 | 1 |
| 0.23361 | 1 |
| 0.23362 | 1 |
| 0.23363 | 1 |
| 0.23364 | 1 |
| 0.23365 | 1 |
| 0.23366 | 1 |
| 0.23367 | 1 |
| 0.23368 | 1 |
| 0.23369 | 1 |
| 0.2337 | 1 |
| 0.23371 | 1 |
| 0.23372 | 1 |
| 0.23373 | 1 |
| 0.23374 | 1 |
| 0.23375 | 1 |
| 0.23376 | 1 |
| 0.23377 | 1 |
| 0.23378 | 1 |
| 0.23379 | 1 |
| 0.2338 | 1 |
| 0.23381 | 1 |
| 0.23382 | 1 |
| 0.23383 | 1 |
| 0.23384 | 1 |
| 0.23385 | 1 |
| 0.23386 | 1 |
| 0.23387 | 1 |
| 0.23388 | 1 |
| 0.23389 | 1 |
| 0.2339 | 1 |
| 0.23391 | 1 |
| 0.23392 | 1 |
| 0.23393 | 1 |
| 0.23394 | 1 |
| 0.23395 | 1 |
| 0.23396 | 1 |
| 0.23397 | 1 |
| 0.23398 | 1 |
| 0.23399 | 1 |
| 0.234 | 1 |
| 0.23401 | 1 |
| 0.23402 | 1 |
| 0.23403 | 1 |
| 0.23404 | 1 |
| 0.23405 | 1 |
| 0.23406 | 1 |
| 0.23407 | 1 |
| 0.23408 | 1 |
| 0.23409 | 1 |
| 0.2341 | 1 |
| 0.23411 | 1 |
| 0.23412 | 1 |
| 0.23413 | 1 |
| 0.23414 | 1 |
| 0.23415 | 1 |
| 0.23416 | 1 |
| 0.23417 | 1 |
| 0.23418 | 1 |
| 0.23419 | 1 |
| 0.2342 | 1 |
| 0.23421 | 1 |
| 0.23422 | 1 |
| 0.23423 | 1 |
| 0.23424 | 1 |
| 0.23425 | 1 |
| 0.23426 | 1 |
| 0.23427 | 1 |
| 0.23428 | 1 |
| 0.23429 | 1 |
| 0.2343 | 1 |
| 0.23431 | 1 |
| 0.23432 | 1 |
| 0.23433 | 1 |
| 0.23434 | 1 |
| 0.23435 | 1 |
| 0.23436 | 1 |
| 0.23437 | 1 |
| 0.23438 | 1 |
| 0.23439 | 1 |
| 0.2344 | 1 |
| 0.23441 | 1 |
| 0.23442 | 1 |
| 0.23443 | 1 |
| 0.23444 | 1 |
| 0.23445 | 1 |
| 0.23446 | 1 |
| 0.23447 | 1 |
| 0.23448 | 1 |
| 0.23449 | 1 |
| 0.2345 | 1 |
| 0.23451 | 1 |
| 0.23452 | 1 |
| 0.23453 | 1 |
| 0.23454 | 1 |
| 0.23455 | 1 |
| 0.23456 | 1 |
| 0.23457 | 1 |
| 0.23458 | 1 |
| 0.23459 | 1 |
| 0.2346 | 1 |
| 0.23461 | 1 |
| 0.23462 | 1 |
| 0.23463 | 1 |
| 0.23464 | 1 |
| 0.23465 | 1 |
| 0.23466 | 1 |
| 0.23467 | 1 |
| 0.23468 | 1 |
| 0.23469 | 1 |
| 0.2347 | 1 |
| 0.23471 | 1 |
| 0.23472 | 1 |
| 0.23473 | 1 |
| 0.23474 | 1 |
| 0.23475 | 1 |
| 0.23476 | 1 |
| 0.23477 | 1 |
| 0.23478 | 1 |
| 0.23479 | 1 |
| 0.2348 | 1 |
| 0.23481 | 1 |
| 0.23482 | 1 |
| 0.23483 | 1 |
| 0.23484 | 1 |
| 0.23485 | 1 |
| 0.23486 | 1 |
| 0.23487 | 1 |
| 0.23488 | 1 |
| 0.23489 | 1 |
| 0.2349 | 1 |
| 0.23491 | 1 |
| 0.23492 | 1 |
| 0.23493 | 1 |
| 0.23494 | 1 |
| 0.23495 | 1 |
| 0.23496 | 1 |
| 0.23497 | 1 |
| 0.23498 | 1 |
| 0.23499 | 1 |
| 0.235 | 1 |
| 0.23501 | 1 |
| 0.23502 | 1 |
| 0.23503 | 1 |
| 0.23504 | 1 |
| 0.23505 | 1 |
| 0.23506 | 1 |
| 0.23507 | 1 |
| 0.23508 | 1 |
| 0.23509 | 1 |
| 0.2351 | 1 |
| 0.23511 | 1 |
| 0.23512 | 1 |
| 0.23513 | 1 |
| 0.23514 | 1 |
| 0.23515 | 1 |
| 0.23516 | 1 |
| 0.23517 | 1 |
| 0.23518 | 1 |
| 0.23519 | 1 |
| 0.2352 | 1 |
| 0.23521 | 1 |
| 0.23522 | 1 |
| 0.23523 | 1 |
| 0.23524 | 1 |
| 0.23525 | 1 |
| 0.23526 | 1 |
| 0.23527 | 1 |
| 0.23528 | 1 |
| 0.23529 | 1 |
| 0.2353 | 1 |
| 0.23531 | 1 |
| 0.23532 | 1 |
| 0.23533 | 1 |
| 0.23534 | 1 |
| 0.23535 | 1 |
| 0.23536 | 1 |
| 0.23537 | 1 |
| 0.23538 | 1 |
| 0.23539 | 1 |
| 0.2354 | 1 |
| 0.23541 | 1 |
| 0.23542 | 1 |
| 0.23543 | 1 |
| 0.23544 | 1 |
| 0.23545 | 1 |
| 0.23546 | 1 |
| 0.23547 | 1 |
| 0.23548 | 1 |
| 0.23549 | 1 |
| 0.2355 | 1 |
| 0.23551 | 1 |
| 0.23552 | 1 |
| 0.23553 | 1 |
| 0.23554 | 1 |
| 0.23555 | 1 |
| 0.23556 | 1 |
| 0.23557 | 1 |
| 0.23558 | 1 |
| 0.23559 | 1 |
| 0.2356 | 1 |
| 0.23561 | 1 |
| 0.23562 | 1 |
| 0.23563 | 1 |
| 0.23564 | 1 |
| 0.23565 | 1 |
| 0.23566 | 1 |
| 0.23567 | 1 |
| 0.23568 | 1 |
| 0.23569 | 1 |
| 0.2357 | 1 |
| 0.23571 | 1 |
| 0.23572 | 1 |
| 0.23573 | 1 |
| 0.23574 | 1 |
| 0.23575 | 1 |
| 0.23576 | 1 |
| 0.23577 | 1 |
| 0.23578 | 1 |
| 0.23579 | 1 |
| 0.2358 | 1 |
| 0.23581 | 1 |
| 0.23582 | 1 |
| 0.23583 | 1 |
| 0.23584 | 1 |
| 0.23585 | 1 |
| 0.23586 | 1 |
| 0.23587 | 1 |
| 0.23588 | 1 |
| 0.23589 | 1 |
| 0.2359 | 1 |
| 0.23591 | 1 |
| 0.23592 | 1 |
| 0.23593 | 1 |
| 0.23594 | 1 |
| 0.23595 | 1 |
| 0.23596 | 1 |
| 0.23597 | 1 |
| 0.23598 | 1 |
| 0.23599 | 1 |
| 0.236 | 1 |
| 0.23601 | 1 |
| 0.23602 | 1 |
| 0.23603 | 1 |
| 0.23604 | 1 |
| 0.23605 | 1 |
| 0.23606 | 1 |
| 0.23607 | 1 |
| 0.23608 | 1 |
| 0.23609 | 1 |
| 0.2361 | 1 |
| 0.23611 | 1 |
| 0.23612 | 1 |
| 0.23613 | 1 |
| 0.23614 | 1 |
| 0.23615 | 1 |
| 0.23616 | 1 |
| 0.23617 | 1 |
| 0.23618 | 1 |
| 0.23619 | 1 |
| 0.2362 | 1 |
| 0.23621 | 1 |
| 0.23622 | 1 |
| 0.23623 | 1 |
| 0.23624 | 1 |
| 0.23625 | 1 |
| 0.23626 | 1 |
| 0.23627 | 1 |
| 0.23628 | 1 |
| 0.23629 | 1 |
| 0.2363 | 1 |
| 0.23631 | 1 |
| 0.23632 | 1 |
| 0.23633 | 1 |
| 0.23634 | 1 |
| 0.23635 | 1 |
| 0.23636 | 1 |
| 0.23637 | 1 |
| 0.23638 | 1 |
| 0.23639 | 1 |
| 0.2364 | 1 |
| 0.23641 | 1 |
| 0.23642 | 1 |
| 0.23643 | 1 |
| 0.23644 | 1 |
| 0.23645 | 1 |
| 0.23646 | 1 |
| 0.23647 | 1 |
| 0.23648 | 1 |
| 0.23649 | 1 |
| 0.2365 | 1 |
| 0.23651 | 1 |
| 0.23652 | 1 |
| 0.23653 | 1 |
| 0.23654 | 1 |
| 0.23655 | 1 |
| 0.23656 | 1 |
| 0.23657 | 1 |
| 0.23658 | 1 |
| 0.23659 | 1 |
| 0.2366 | 1 |
| 0.23661 | 1 |
| 0.23662 | 1 |
| 0.23663 | 1 |
| 0.23664 | 1 |
| 0.23665 | 1 |
| 0.23666 | 1 |
| 0.23667 | 1 |
| 0.23668 | 1 |
| 0.23669 | 1 |
| 0.2367 | 1 |
| 0.23671 | 1 |
| 0.23672 | 1 |
| 0.23673 | 1 |
| 0.23674 | 1 |
| 0.23675 | 1 |
| 0.23676 | 1 |
| 0.23677 | 1 |
| 0.23678 | 1 |
| 0.23679 | 1 |
| 0.2368 | 1 |
| 0.23681 | 1 |
| 0.23682 | 1 |
| 0.23683 | 1 |
| 0.23684 | 1 |
| 0.23685 | 1 |
| 0.23686 | 1 |
| 0.23687 | 1 |
| 0.23688 | 1 |
| 0.23689 | 1 |
| 0.2369 | 1 |
| 0.23691 | 1 |
| 0.23692 | 1 |
| 0.23693 | 1 |
| 0.23694 | 1 |
| 0.23695 | 1 |
| 0.23696 | 1 |
| 0.23697 | 1 |
| 0.23698 | 1 |
| 0.23699 | 1 |
| 0.237 | 1 |
| 0.23701 | 1 |
| 0.23702 | 1 |
| 0.23703 | 1 |
| 0.23704 | 1 |
| 0.23705 | 1 |
| 0.23706 | 1 |
| 0.23707 | 1 |
| 0.23708 | 1 |
| 0.23709 | 1 |
| 0.2371 | 1 |
| 0.23711 | 1 |
| 0.23712 | 1 |
| 0.23713 | 1 |
| 0.23714 | 1 |
| 0.23715 | 1 |
| 0.23716 | 1 |
| 0.23717 | 1 |
| 0.23718 | 1 |
| 0.23719 | 1 |
| 0.2372 | 1 |
| 0.23721 | 1 |
| 0.23722 | 1 |
| 0.23723 | 1 |
| 0.23724 | 1 |
| 0.23725 | 1 |
| 0.23726 | 1 |
| 0.23727 | 1 |
| 0.23728 | 1 |
| 0.23729 | 1 |
| 0.2373 | 1 |
| 0.23731 | 1 |
| 0.23732 | 1 |
| 0.23733 | 1 |
| 0.23734 | 1 |
| 0.23735 | 1 |
| 0.23736 | 1 |
| 0.23737 | 1 |
| 0.23738 | 1 |
| 0.23739 | 1 |
| 0.2374 | 1 |
| 0.23741 | 1 |
| 0.23742 | 1 |
| 0.23743 | 1 |
| 0.23744 | 1 |
| 0.23745 | 1 |
| 0.23746 | 1 |
| 0.23747 | 1 |
| 0.23748 | 1 |
| 0.23749 | 1 |
| 0.2375 | 1 |
| 0.23751 | 1 |
| 0.23752 | 1 |
| 0.23753 | 1 |
| 0.23754 | 1 |
| 0.23755 | 1 |
| 0.23756 | 1 |
| 0.23757 | 1 |
| 0.23758 | 1 |
| 0.23759 | 1 |
| 0.2376 | 1 |
| 0.23761 | 1 |
| 0.23762 | 1 |
| 0.23763 | 1 |
| 0.23764 | 1 |
| 0.23765 | 1 |
| 0.23766 | 1 |
| 0.23767 | 1 |
| 0.23768 | 1 |
| 0.23769 | 1 |
| 0.2377 | 1 |
| 0.23771 | 1 |
| 0.23772 | 1 |
| 0.23773 | 1 |
| 0.23774 | 1 |
| 0.23775 | 1 |
| 0.23776 | 1 |
| 0.23777 | 1 |
| 0.23778 | 1 |
| 0.23779 | 1 |
| 0.2378 | 1 |
| 0.23781 | 1 |
| 0.23782 | 1 |
| 0.23783 | 1 |
| 0.23784 | 1 |
| 0.23785 | 1 |
| 0.23786 | 1 |
| 0.23787 | 1 |
| 0.23788 | 1 |
| 0.23789 | 1 |
| 0.2379 | 1 |
| 0.23791 | 1 |
| 0.23792 | 1 |
| 0.23793 | 1 |
| 0.23794 | 1 |
| 0.23795 | 1 |
| 0.23796 | 1 |
| 0.23797 | 1 |
| 0.23798 | 1 |
| 0.23799 | 1 |
| 0.238 | 1 |
| 0.23801 | 1 |
| 0.23802 | 1 |
| 0.23803 | 1 |
| 0.23804 | 1 |
| 0.23805 | 1 |
| 0.23806 | 1 |
| 0.23807 | 1 |
| 0.23808 | 1 |
| 0.23809 | 1 |
| 0.2381 | 1 |
| 0.23811 | 1 |
| 0.23812 | 1 |
| 0.23813 | 1 |
| 0.23814 | 1 |
| 0.23815 | 1 |
| 0.23816 | 1 |
| 0.23817 | 1 |
| 0.23818 | 1 |
| 0.23819 | 1 |
| 0.2382 | 1 |
| 0.23821 | 1 |
| 0.23822 | 1 |
| 0.23823 | 1 |
| 0.23824 | 1 |
| 0.23825 | 1 |
| 0.23826 | 1 |
| 0.23827 | 1 |
| 0.23828 | 1 |
| 0.23829 | 1 |
| 0.2383 | 1 |
| 0.23831 | 1 |
| 0.23832 | 1 |
| 0.23833 | 1 |
| 0.23834 | 1 |
| 0.23835 | 1 |
| 0.23836 | 1 |
| 0.23837 | 1 |
| 0.23838 | 1 |
| 0.23839 | 1 |
| 0.2384 | 1 |
| 0.23841 | 1 |
| 0.23842 | 1 |
| 0.23843 | 1 |
| 0.23844 | 1 |
| 0.23845 | 1 |
| 0.23846 | 1 |
| 0.23847 | 1 |
| 0.23848 | 1 |
| 0.23849 | 1 |
| 0.2385 | 1 |
| 0.23851 | 1 |
| 0.23852 | 0.999 |
| 0.23853 | 0.999 |
| 0.23854 | 1 |
| 0.23855 | 1 |
| 0.23856 | 1 |
| 0.23857 | 0.999 |
| 0.23858 | 0.999 |
| 0.23859 | 0.999 |
| 0.2386 | 0.999 |
| 0.23861 | 0.999 |
| 0.23862 | 0.999 |
| 0.23863 | 0.999 |
| 0.23864 | 0.999 |
| 0.23865 | 0.999 |
| 0.23866 | 0.999 |
| 0.23867 | 0.999 |
| 0.23868 | 0.999 |
| 0.23869 | 0.999 |
| 0.2387 | 0.999 |
| 0.23871 | 0.999 |
| 0.23872 | 0.999 |
| 0.23873 | 0.999 |
| 0.23874 | 0.999 |
| 0.23875 | 0.999 |
| 0.23876 | 0.999 |
| 0.23877 | 0.999 |
| 0.23878 | 0.999 |
| 0.23879 | 0.999 |
| 0.2388 | 0.999 |
| 0.23881 | 1 |
| 0.23882 | 1 |
| 0.23883 | 0.999 |
| 0.23884 | 1 |
| 0.23885 | 0.999 |
| 0.23886 | 0.999 |
| 0.23887 | 0.999 |
| 0.23888 | 1 |
| 0.23889 | 1 |
| 0.2389 | 1 |
| 0.23891 | 1 |
| 0.23892 | 1 |
| 0.23893 | 1 |
| 0.23894 | 1 |
| 0.23895 | 1 |
| 0.23896 | 1 |
| 0.23897 | 1 |
| 0.23898 | 1 |
| 0.23899 | 1 |
| 0.239 | 1 |
| 0.23901 | 1 |
| 0.23902 | 1 |
| 0.23903 | 1 |
| 0.23904 | 1 |
| 0.23905 | 1 |
| 0.23906 | 1 |
| 0.23907 | 1 |
| 0.23908 | 1 |
| 0.23909 | 1 |
| 0.2391 | 1 |
| 0.23911 | 1 |
| 0.23912 | 1 |
| 0.23913 | 1 |
| 0.23914 | 1 |
| 0.23915 | 1 |
| 0.23916 | 1 |
| 0.23917 | 1 |
| 0.23918 | 1 |
| 0.23919 | 1 |
| 0.2392 | 1 |
| 0.23921 | 1 |
| 0.23922 | 1 |
| 0.23923 | 1 |
| 0.23924 | 1 |
| 0.23925 | 1 |
| 0.23926 | 1 |
| 0.23927 | 1 |
| 0.23928 | 1 |
| 0.23929 | 1 |
| 0.2393 | 1 |
| 0.23931 | 1 |
| 0.23932 | 1 |
| 0.23933 | 1 |
| 0.23934 | 1 |
| 0.23935 | 1 |
| 0.23936 | 1 |
| 0.23937 | 1 |
| 0.23938 | 1 |
| 0.23939 | 1 |
| 0.2394 | 1 |
| 0.23941 | 1 |
| 0.23942 | 1 |
| 0.23943 | 1 |
| 0.23944 | 1 |
| 0.23945 | 1 |
| 0.23946 | 1 |
| 0.23947 | 1 |
| 0.23948 | 1 |
| 0.23949 | 1 |
| 0.2395 | 1 |
| 0.23951 | 1 |
| 0.23952 | 1 |
| 0.23953 | 1 |
| 0.23954 | 1 |
| 0.23955 | 1 |
| 0.23956 | 1 |
| 0.23957 | 1 |
| 0.23958 | 1 |
| 0.23959 | 1 |
| 0.2396 | 1 |
| 0.23961 | 1 |
| 0.23962 | 1 |
| 0.23963 | 1 |
| 0.23964 | 1 |
| 0.23965 | 1 |
| 0.23966 | 1 |
| 0.23967 | 1 |
| 0.23968 | 1 |
| 0.23969 | 1 |
| 0.2397 | 1 |
| 0.23971 | 1 |
| 0.23972 | 1 |
| 0.23973 | 1 |
| 0.23974 | 1 |
| 0.23975 | 1 |
| 0.23976 | 1 |
| 0.23977 | 1 |
| 0.23978 | 1 |
| 0.23979 | 1 |
| 0.2398 | 1 |
| 0.23981 | 1 |
| 0.23982 | 1 |
| 0.23983 | 1 |
| 0.23984 | 1 |
| 0.23985 | 1 |
| 0.23986 | 1 |
| 0.23987 | 1 |
| 0.23988 | 1 |
| 0.23989 | 1 |
| 0.2399 | 1 |
| 0.23991 | 1 |
| 0.23992 | 1 |
| 0.23993 | 1 |
| 0.23994 | 1 |
| 0.23995 | 1 |
| 0.23996 | 1 |
| 0.23997 | 1 |
| 0.23998 | 1 |
| 0.23999 | 1 |
| 0.24 | 1 |
| 0.24001 | 1 |
| 0.24002 | 1 |
| 0.24003 | 1 |
| 0.24004 | 1 |
| 0.24005 | 1 |
| 0.24006 | 1 |
| 0.24007 | 1 |
| 0.24008 | 1 |
| 0.24009 | 1 |
| 0.2401 | 1 |
| 0.24011 | 1 |
| 0.24012 | 1 |
| 0.24013 | 1 |
| 0.24014 | 1 |
| 0.24015 | 1 |
| 0.24016 | 1 |
| 0.24017 | 1 |
| 0.24018 | 1 |
| 0.24019 | 1 |
| 0.2402 | 1 |
| 0.24021 | 1 |
| 0.24022 | 1 |
| 0.24023 | 1 |
| 0.24024 | 1 |
| 0.24025 | 1 |
| 0.24026 | 1 |
| 0.24027 | 1 |
| 0.24028 | 1 |
| 0.24029 | 1 |
| 0.2403 | 1 |
| 0.24031 | 1 |
| 0.24032 | 1 |
| 0.24033 | 1 |
| 0.24034 | 1 |
| 0.24035 | 1 |
| 0.24036 | 1 |
| 0.24037 | 1 |
| 0.24038 | 1 |
| 0.24039 | 1 |
| 0.2404 | 1 |
| 0.24041 | 1 |
| 0.24042 | 1 |
| 0.24043 | 1 |
| 0.24044 | 1 |
| 0.24045 | 1 |
| 0.24046 | 1 |
| 0.24047 | 1 |
| 0.24048 | 1 |
| 0.24049 | 1 |
| 0.2405 | 1 |
| 0.24051 | 1 |
| 0.24052 | 1 |
| 0.24053 | 1 |
| 0.24054 | 1 |
| 0.24055 | 1 |
| 0.24056 | 1 |
| 0.24057 | 1 |
| 0.24058 | 1 |
| 0.24059 | 1 |
| 0.2406 | 1 |
| 0.24061 | 1 |
| 0.24062 | 1 |
| 0.24063 | 1 |
| 0.24064 | 1 |
| 0.24065 | 1 |
| 0.24066 | 1 |
| 0.24067 | 1 |
| 0.24068 | 1 |
| 0.24069 | 1 |
| 0.2407 | 1 |
| 0.24071 | 1 |
| 0.24072 | 1 |
| 0.24073 | 1 |
| 0.24074 | 1 |
| 0.24075 | 1 |
| 0.24076 | 1 |
| 0.24077 | 1 |
| 0.24078 | 1 |
| 0.24079 | 1 |
| 0.2408 | 1 |
| 0.24081 | 1 |
| 0.24082 | 1 |
| 0.24083 | 1 |
| 0.24084 | 1 |
| 0.24085 | 1 |
| 0.24086 | 1 |
| 0.24087 | 1 |
| 0.24088 | 1 |
| 0.24089 | 1 |
| 0.2409 | 1 |
| 0.24091 | 1 |
| 0.24092 | 1 |
| 0.24093 | 1 |
| 0.24094 | 1 |
| 0.24095 | 1 |
| 0.24096 | 1 |
| 0.24097 | 1 |
| 0.24098 | 1 |
| 0.24099 | 1 |
| 0.241 | 1 |
| 0.24101 | 1 |
| 0.24102 | 1 |
| 0.24103 | 1 |
| 0.24104 | 1 |
| 0.24105 | 1 |
| 0.24106 | 1 |
| 0.24107 | 1 |
| 0.24108 | 1 |
| 0.24109 | 1 |
| 0.2411 | 1 |
| 0.24111 | 1 |
| 0.24112 | 1 |
| 0.24113 | 1 |
| 0.24114 | 1 |
| 0.24115 | 1 |
| 0.24116 | 1 |
| 0.24117 | 1 |
| 0.24118 | 1 |
| 0.24119 | 1 |
| 0.2412 | 1 |
| 0.24121 | 1 |
| 0.24122 | 1 |
| 0.24123 | 1 |
| 0.24124 | 1 |
| 0.24125 | 1 |
| 0.24126 | 1 |
| 0.24127 | 1 |
| 0.24128 | 1 |
| 0.24129 | 1 |
| 0.2413 | 1 |
| 0.24131 | 1 |
| 0.24132 | 1 |
| 0.24133 | 1 |
| 0.24134 | 1 |
| 0.24135 | 1 |
| 0.24136 | 1 |
| 0.24137 | 1 |
| 0.24138 | 1 |
| 0.24139 | 1 |
| 0.2414 | 1 |
| 0.24141 | 1 |
| 0.24142 | 1 |
| 0.24143 | 1 |
| 0.24144 | 1 |
| 0.24145 | 1 |
| 0.24146 | 1 |
| 0.24147 | 1 |
| 0.24148 | 1 |
| 0.24149 | 1 |
| 0.2415 | 1 |
| 0.24151 | 1 |
| 0.24152 | 1 |
| 0.24153 | 1 |
| 0.24154 | 1 |
| 0.24155 | 1 |
| 0.24156 | 1 |
| 0.24157 | 1 |
| 0.24158 | 1 |
| 0.24159 | 1 |
| 0.2416 | 1 |
| 0.24161 | 1 |
| 0.24162 | 1 |
| 0.24163 | 1 |
| 0.24164 | 1 |
| 0.24165 | 1 |
| 0.24166 | 1 |
| 0.24167 | 1 |
| 0.24168 | 1 |
| 0.24169 | 1 |
| 0.2417 | 1 |
| 0.24171 | 1 |
| 0.24172 | 1 |
| 0.24173 | 1 |
| 0.24174 | 1 |
| 0.24175 | 1 |
| 0.24176 | 1 |
| 0.24177 | 1 |
| 0.24178 | 1 |
| 0.24179 | 1 |
| 0.2418 | 1 |
| 0.24181 | 1 |
| 0.24182 | 1 |
| 0.24183 | 1 |
| 0.24184 | 1 |
| 0.24185 | 1 |
| 0.24186 | 1 |
| 0.24187 | 1 |
| 0.24188 | 1 |
| 0.24189 | 1 |
| 0.2419 | 1 |
| 0.24191 | 1 |
| 0.24192 | 1 |
| 0.24193 | 1 |
| 0.24194 | 1 |
| 0.24195 | 1 |
| 0.24196 | 1 |
| 0.24197 | 1 |
| 0.24198 | 1 |
| 0.24199 | 1 |
| 0.242 | 1 |
| 0.24201 | 1 |
| 0.24202 | 1 |
| 0.24203 | 1 |
| 0.24204 | 1 |
| 0.24205 | 1 |
| 0.24206 | 1 |
| 0.24207 | 1 |
| 0.24208 | 1 |
| 0.24209 | 1 |
| 0.2421 | 1 |
| 0.24211 | 1 |
| 0.24212 | 1 |
| 0.24213 | 1 |
| 0.24214 | 1 |
| 0.24215 | 1 |
| 0.24216 | 1 |
| 0.24217 | 1 |
| 0.24218 | 1 |
| 0.24219 | 1 |
| 0.2422 | 1 |
| 0.24221 | 1 |
| 0.24222 | 1 |
| 0.24223 | 1 |
| 0.24224 | 1 |
| 0.24225 | 1 |
| 0.24226 | 1 |
| 0.24227 | 1 |
| 0.24228 | 1 |
| 0.24229 | 1 |
| 0.2423 | 1 |
| 0.24231 | 1 |
| 0.24232 | 1 |
| 0.24233 | 1 |
| 0.24234 | 1 |
| 0.24235 | 1 |
| 0.24236 | 1 |
| 0.24237 | 1 |
| 0.24238 | 1 |
| 0.24239 | 1 |
| 0.2424 | 1 |
| 0.24241 | 1 |
| 0.24242 | 1 |
| 0.24243 | 1 |
| 0.24244 | 1 |
| 0.24245 | 1 |
| 0.24246 | 1 |
| 0.24247 | 1 |
| 0.24248 | 1 |
| 0.24249 | 1 |
| 0.2425 | 1 |
| 0.24251 | 1 |
| 0.24252 | 1 |
| 0.24253 | 1 |
| 0.24254 | 1 |
| 0.24255 | 1 |
| 0.24256 | 1 |
| 0.24257 | 1 |
| 0.24258 | 1 |
| 0.24259 | 1 |
| 0.2426 | 1 |
| 0.24261 | 1 |
| 0.24262 | 1 |
| 0.24263 | 1 |
| 0.24264 | 1 |
| 0.24265 | 1 |
| 0.24266 | 1 |
| 0.24267 | 1 |
| 0.24268 | 1 |
| 0.24269 | 1 |
| 0.2427 | 1 |
| 0.24271 | 1 |
| 0.24272 | 1 |
| 0.24273 | 1 |
| 0.24274 | 1 |
| 0.24275 | 1 |
| 0.24276 | 1 |
| 0.24277 | 1 |
| 0.24278 | 1 |
| 0.24279 | 1 |
| 0.2428 | 1 |
| 0.24281 | 1 |
| 0.24282 | 1 |
| 0.24283 | 1 |
| 0.24284 | 1 |
| 0.24285 | 1 |
| 0.24286 | 1 |
| 0.24287 | 1 |
| 0.24288 | 1 |
| 0.24289 | 1 |
| 0.2429 | 1 |
| 0.24291 | 1 |
| 0.24292 | 1 |
| 0.24293 | 1 |
| 0.24294 | 1 |
| 0.24295 | 1 |
| 0.24296 | 1 |
| 0.24297 | 1 |
| 0.24298 | 1 |
| 0.24299 | 1 |
| 0.243 | 1 |
| 0.24301 | 1 |
| 0.24302 | 1 |
| 0.24303 | 1 |
| 0.24304 | 1 |
| 0.24305 | 1 |
| 0.24306 | 1 |
| 0.24307 | 1 |
| 0.24308 | 1 |
| 0.24309 | 1 |
| 0.2431 | 1 |
| 0.24311 | 1 |
| 0.24312 | 1 |
| 0.24313 | 1 |
| 0.24314 | 1 |
| 0.24315 | 1 |
| 0.24316 | 1 |
| 0.24317 | 1 |
| 0.24318 | 1 |
| 0.24319 | 1 |
| 0.2432 | 1 |
| 0.24321 | 1 |
| 0.24322 | 1 |
| 0.24323 | 1 |
| 0.24324 | 1 |
| 0.24325 | 1 |
| 0.24326 | 1 |
| 0.24327 | 1 |
| 0.24328 | 1 |
| 0.24329 | 1 |
| 0.2433 | 1 |
| 0.24331 | 1 |
| 0.24332 | 1 |
| 0.24333 | 1 |
| 0.24334 | 1 |
| 0.24335 | 1 |
| 0.24336 | 1 |
| 0.24337 | 1 |
| 0.24338 | 1 |
| 0.24339 | 1 |
| 0.2434 | 1 |
| 0.24341 | 1 |
| 0.24342 | 1 |
| 0.24343 | 1 |
| 0.24344 | 1 |
| 0.24345 | 1 |
| 0.24346 | 1 |
| 0.24347 | 1 |
| 0.24348 | 1 |
| 0.24349 | 1 |
| 0.2435 | 1 |
| 0.24351 | 1 |
| 0.24352 | 1 |
| 0.24353 | 1 |
| 0.24354 | 1 |
| 0.24355 | 1 |
| 0.24356 | 1 |
| 0.24357 | 1 |
| 0.24358 | 1 |
| 0.24359 | 1 |
| 0.2436 | 1 |
| 0.24361 | 1 |
| 0.24362 | 1 |
| 0.24363 | 1 |
| 0.24364 | 1 |
| 0.24365 | 1 |
| 0.24366 | 1 |
| 0.24367 | 1 |
| 0.24368 | 1 |
| 0.24369 | 1 |
| 0.2437 | 1 |
| 0.24371 | 1 |
| 0.24372 | 1 |
| 0.24373 | 1 |
| 0.24374 | 1 |
| 0.24375 | 1 |
| 0.24376 | 1 |
| 0.24377 | 1 |
| 0.24378 | 1 |
| 0.24379 | 1 |
| 0.2438 | 1 |
| 0.24381 | 1 |
| 0.24382 | 1 |
| 0.24383 | 1 |
| 0.24384 | 1 |
| 0.24385 | 1 |
| 0.24386 | 1 |
| 0.24387 | 1 |
| 0.24388 | 1 |
| 0.24389 | 1 |
| 0.2439 | 1 |
| 0.24391 | 1 |
| 0.24392 | 1 |
| 0.24393 | 1 |
| 0.24394 | 1 |
| 0.24395 | 1 |
| 0.24396 | 1 |
| 0.24397 | 1 |
| 0.24398 | 1 |
| 0.24399 | 1 |
| 0.244 | 1 |
| 0.24401 | 1 |
| 0.24402 | 1 |
| 0.24403 | 1 |
| 0.24404 | 1 |
| 0.24405 | 1 |
| 0.24406 | 1 |
| 0.24407 | 1 |
| 0.24408 | 1 |
| 0.24409 | 1 |
| 0.2441 | 1 |
| 0.24411 | 1 |
| 0.24412 | 1 |
| 0.24413 | 1 |
| 0.24414 | 1 |
| 0.24415 | 1 |
| 0.24416 | 1 |
| 0.24417 | 1 |
| 0.24418 | 1 |
| 0.24419 | 1 |
| 0.2442 | 1 |
| 0.24421 | 1 |
| 0.24422 | 1 |
| 0.24423 | 1 |
| 0.24424 | 1 |
| 0.24425 | 1 |
| 0.24426 | 1 |
| 0.24427 | 1 |
| 0.24428 | 1 |
| 0.24429 | 1 |
| 0.2443 | 1 |
| 0.24431 | 1 |
| 0.24432 | 1 |
| 0.24433 | 1 |
| 0.24434 | 1 |
| 0.24435 | 1 |
| 0.24436 | 1 |
| 0.24437 | 1 |
| 0.24438 | 1 |
| 0.24439 | 1 |
| 0.2444 | 1 |
| 0.24441 | 1 |
| 0.24442 | 1 |
| 0.24443 | 1 |
| 0.24444 | 1 |
| 0.24445 | 1 |
| 0.24446 | 1 |
| 0.24447 | 1 |
| 0.24448 | 1 |
| 0.24449 | 1 |
| 0.2445 | 1 |
| 0.24451 | 1 |
| 0.24452 | 1 |
| 0.24453 | 1 |
| 0.24454 | 1 |
| 0.24455 | 1 |
| 0.24456 | 1 |
| 0.24457 | 1 |
| 0.24458 | 1 |
| 0.24459 | 1 |
| 0.2446 | 1 |
| 0.24461 | 1 |
| 0.24462 | 1 |
| 0.24463 | 1 |
| 0.24464 | 1 |
| 0.24465 | 1 |
| 0.24466 | 1 |
| 0.24467 | 1 |
| 0.24468 | 1 |
| 0.24469 | 1 |
| 0.2447 | 1 |
| 0.24471 | 1 |
| 0.24472 | 1 |
| 0.24473 | 1 |
| 0.24474 | 1 |
| 0.24475 | 1 |
| 0.24476 | 1 |
| 0.24477 | 1 |
| 0.24478 | 1 |
| 0.24479 | 1 |
| 0.2448 | 1 |
| 0.24481 | 1 |
| 0.24482 | 1 |
| 0.24483 | 1 |
| 0.24484 | 1 |
| 0.24485 | 1 |
| 0.24486 | 1 |
| 0.24487 | 1 |
| 0.24488 | 1 |
| 0.24489 | 1 |
| 0.2449 | 1 |
| 0.24491 | 1 |
| 0.24492 | 1 |
| 0.24493 | 1 |
| 0.24494 | 1 |
| 0.24495 | 1 |
| 0.24496 | 1 |
| 0.24497 | 1 |
| 0.24498 | 1 |
| 0.24499 | 1 |
| 0.245 | 1 |
| 0.24501 | 1 |
| 0.24502 | 1 |
| 0.24503 | 1 |
| 0.24504 | 1 |
| 0.24505 | 1 |
| 0.24506 | 1 |
| 0.24507 | 1 |
| 0.24508 | 1 |
| 0.24509 | 1 |
| 0.2451 | 1 |
| 0.24511 | 1 |
| 0.24512 | 1 |
| 0.24513 | 1 |
| 0.24514 | 1 |
| 0.24515 | 1 |
| 0.24516 | 1 |
| 0.24517 | 1 |
| 0.24518 | 1 |
| 0.24519 | 1 |
| 0.2452 | 1 |
| 0.24521 | 1 |
| 0.24522 | 1 |
| 0.24523 | 1 |
| 0.24524 | 1 |
| 0.24525 | 1 |
| 0.24526 | 1 |
| 0.24527 | 1 |
| 0.24528 | 1 |
| 0.24529 | 1 |
| 0.2453 | 1 |
| 0.24531 | 1 |
| 0.24532 | 1 |
| 0.24533 | 1 |
| 0.24534 | 1 |
| 0.24535 | 1 |
| 0.24536 | 1 |
| 0.24537 | 1 |
| 0.24538 | 1 |
| 0.24539 | 1 |
| 0.2454 | 1 |
| 0.24541 | 1 |
| 0.24542 | 1 |
| 0.24543 | 1 |
| 0.24544 | 1 |
| 0.24545 | 1 |
| 0.24546 | 1 |
| 0.24547 | 1 |
| 0.24548 | 1 |
| 0.24549 | 1 |
| 0.2455 | 1 |
| 0.24551 | 1 |
| 0.24552 | 1 |
| 0.24553 | 1 |
| 0.24554 | 1 |
| 0.24555 | 1 |
| 0.24556 | 1 |
| 0.24557 | 1 |
| 0.24558 | 1 |
| 0.24559 | 1 |
| 0.2456 | 1 |
| 0.24561 | 1 |
| 0.24562 | 1 |
| 0.24563 | 1 |
| 0.24564 | 1 |
| 0.24565 | 1 |
| 0.24566 | 1 |
| 0.24567 | 1 |
| 0.24568 | 1 |
| 0.24569 | 1 |
| 0.2457 | 1 |
| 0.24571 | 1 |
| 0.24572 | 1 |
| 0.24573 | 1 |
| 0.24574 | 1 |
| 0.24575 | 1 |
| 0.24576 | 1 |
| 0.24577 | 1 |
| 0.24578 | 1 |
| 0.24579 | 1 |
| 0.2458 | 1 |
| 0.24581 | 1 |
| 0.24582 | 1 |
| 0.24583 | 1 |
| 0.24584 | 1 |
| 0.24585 | 1 |
| 0.24586 | 1 |
| 0.24587 | 1 |
| 0.24588 | 1 |
| 0.24589 | 1 |
| 0.2459 | 1 |
| 0.24591 | 1 |
| 0.24592 | 1 |
| 0.24593 | 1 |
| 0.24594 | 1 |
| 0.24595 | 1 |
| 0.24596 | 1 |
| 0.24597 | 1 |
| 0.24598 | 1 |
| 0.24599 | 1 |
| 0.246 | 1 |
| 0.24601 | 1 |
| 0.24602 | 1 |
| 0.24603 | 1 |
| 0.24604 | 1 |
| 0.24605 | 1 |
| 0.24606 | 1 |
| 0.24607 | 1 |
| 0.24608 | 1 |
| 0.24609 | 1 |
| 0.2461 | 1 |
| 0.24611 | 1 |
| 0.24612 | 1 |
| 0.24613 | 1 |
| 0.24614 | 1 |
| 0.24615 | 1 |
| 0.24616 | 1 |
| 0.24617 | 1 |
| 0.24618 | 1 |
| 0.24619 | 1 |
| 0.2462 | 1 |
| 0.24621 | 1 |
| 0.24622 | 1 |
| 0.24623 | 1 |
| 0.24624 | 1 |
| 0.24625 | 1 |
| 0.24626 | 1 |
| 0.24627 | 1 |
| 0.24628 | 1 |
| 0.24629 | 1 |
| 0.2463 | 1 |
| 0.24631 | 1 |
| 0.24632 | 1 |
| 0.24633 | 1 |
| 0.24634 | 1 |
| 0.24635 | 1 |
| 0.24636 | 1 |
| 0.24637 | 1 |
| 0.24638 | 1 |
| 0.24639 | 1 |
| 0.2464 | 1 |
| 0.24641 | 1 |
| 0.24642 | 1 |
| 0.24643 | 1 |
| 0.24644 | 1 |
| 0.24645 | 1 |
| 0.24646 | 1 |
| 0.24647 | 1 |
| 0.24648 | 1 |
| 0.24649 | 1 |
| 0.2465 | 1 |
| 0.24651 | 1 |
| 0.24652 | 1 |
| 0.24653 | 1 |
| 0.24654 | 1 |
| 0.24655 | 1 |
| 0.24656 | 1 |
| 0.24657 | 1 |
| 0.24658 | 1 |
| 0.24659 | 1 |
| 0.2466 | 1 |
| 0.24661 | 1 |
| 0.24662 | 1 |
| 0.24663 | 1 |
| 0.24664 | 1 |
| 0.24665 | 1 |
| 0.24666 | 1 |
| 0.24667 | 1 |
| 0.24668 | 1 |
| 0.24669 | 1 |
| 0.2467 | 1 |
| 0.24671 | 1 |
| 0.24672 | 1 |
| 0.24673 | 1 |
| 0.24674 | 1 |
| 0.24675 | 1 |
| 0.24676 | 1 |
| 0.24677 | 1 |
| 0.24678 | 1 |
| 0.24679 | 1 |
| 0.2468 | 1 |
| 0.24681 | 1 |
| 0.24682 | 1 |
| 0.24683 | 1 |
| 0.24684 | 1 |
| 0.24685 | 1 |
| 0.24686 | 1 |
| 0.24687 | 1 |
| 0.24688 | 1 |
| 0.24689 | 1 |
| 0.2469 | 1 |
| 0.24691 | 1 |
| 0.24692 | 1 |
| 0.24693 | 1 |
| 0.24694 | 1 |
| 0.24695 | 1 |
| 0.24696 | 1 |
| 0.24697 | 1 |
| 0.24698 | 1 |
| 0.24699 | 1 |
| 0.247 | 1 |
| 0.24701 | 1 |
| 0.24702 | 1 |
| 0.24703 | 1 |
| 0.24704 | 1 |
| 0.24705 | 1 |
| 0.24706 | 1 |
| 0.24707 | 1 |
| 0.24708 | 1 |
| 0.24709 | 1 |
| 0.2471 | 1 |
| 0.24711 | 1 |
| 0.24712 | 1 |
| 0.24713 | 1 |
| 0.24714 | 1 |
| 0.24715 | 1 |
| 0.24716 | 1 |
| 0.24717 | 1 |
| 0.24718 | 1 |
| 0.24719 | 1 |
| 0.2472 | 1 |
| 0.24721 | 1 |
| 0.24722 | 1 |
| 0.24723 | 1 |
| 0.24724 | 1 |
| 0.24725 | 1 |
| 0.24726 | 1 |
| 0.24727 | 1 |
| 0.24728 | 1 |
| 0.24729 | 1 |
| 0.2473 | 1 |
| 0.24731 | 1 |
| 0.24732 | 1 |
| 0.24733 | 1 |
| 0.24734 | 1 |
| 0.24735 | 1 |
| 0.24736 | 1 |
| 0.24737 | 1 |
| 0.24738 | 1 |
| 0.24739 | 1 |
| 0.2474 | 1 |
| 0.24741 | 1 |
| 0.24742 | 1 |
| 0.24743 | 1 |
| 0.24744 | 1 |
| 0.24745 | 1 |
| 0.24746 | 1 |
| 0.24747 | 1 |
| 0.24748 | 1 |
| 0.24749 | 1 |
| 0.2475 | 1 |
| 0.24751 | 1 |
| 0.24752 | 1 |
| 0.24753 | 1 |
| 0.24754 | 1 |
| 0.24755 | 1 |
| 0.24756 | 1 |
| 0.24757 | 1 |
| 0.24758 | 1 |
| 0.24759 | 1 |
| 0.2476 | 1 |
| 0.24761 | 1 |
| 0.24762 | 1 |
| 0.24763 | 1 |
| 0.24764 | 1 |
| 0.24765 | 1 |
| 0.24766 | 1 |
| 0.24767 | 1 |
| 0.24768 | 1 |
| 0.24769 | 1 |
| 0.2477 | 1 |
| 0.24771 | 1 |
| 0.24772 | 1 |
| 0.24773 | 1 |
| 0.24774 | 1 |
| 0.24775 | 1 |
| 0.24776 | 1 |
| 0.24777 | 1 |
| 0.24778 | 1 |
| 0.24779 | 1 |
| 0.2478 | 1 |
| 0.24781 | 1 |
| 0.24782 | 1 |
| 0.24783 | 1 |
| 0.24784 | 1 |
| 0.24785 | 1 |
| 0.24786 | 1 |
| 0.24787 | 1 |
| 0.24788 | 1 |
| 0.24789 | 1 |
| 0.2479 | 1 |
| 0.24791 | 1 |
| 0.24792 | 1 |
| 0.24793 | 1 |
| 0.24794 | 1 |
| 0.24795 | 1 |
| 0.24796 | 1 |
| 0.24797 | 1 |
| 0.24798 | 1 |
| 0.24799 | 1 |
| 0.248 | 1 |
| 0.24801 | 1 |
| 0.24802 | 1 |
| 0.24803 | 1 |
| 0.24804 | 1 |
| 0.24805 | 1 |
| 0.24806 | 1 |
| 0.24807 | 1 |
| 0.24808 | 1 |
| 0.24809 | 1 |
| 0.2481 | 1 |
| 0.24811 | 1 |
| 0.24812 | 1 |
| 0.24813 | 1 |
| 0.24814 | 1 |
| 0.24815 | 1 |
| 0.24816 | 1 |
| 0.24817 | 1 |
| 0.24818 | 1 |
| 0.24819 | 1 |
| 0.2482 | 1 |
| 0.24821 | 1 |
| 0.24822 | 1 |
| 0.24823 | 1 |
| 0.24824 | 1 |
| 0.24825 | 1 |
| 0.24826 | 1 |
| 0.24827 | 1 |
| 0.24828 | 1 |
| 0.24829 | 1 |
| 0.2483 | 1 |
| 0.24831 | 1 |
| 0.24832 | 1 |
| 0.24833 | 1 |
| 0.24834 | 1 |
| 0.24835 | 1 |
| 0.24836 | 1 |
| 0.24837 | 1 |
| 0.24838 | 1 |
| 0.24839 | 1 |
| 0.2484 | 1 |
| 0.24841 | 1 |
| 0.24842 | 1 |
| 0.24843 | 1 |
| 0.24844 | 1 |
| 0.24845 | 1 |
| 0.24846 | 1 |
| 0.24847 | 1 |
| 0.24848 | 1 |
| 0.24849 | 1 |
| 0.2485 | 1 |
| 0.24851 | 1 |
| 0.24852 | 1 |
| 0.24853 | 1 |
| 0.24854 | 1 |
| 0.24855 | 1 |
| 0.24856 | 1 |
| 0.24857 | 1 |
| 0.24858 | 1 |
| 0.24859 | 1 |
| 0.2486 | 1 |
| 0.24861 | 1 |
| 0.24862 | 1 |
| 0.24863 | 1 |
| 0.24864 | 1 |
| 0.24865 | 1 |
| 0.24866 | 1 |
| 0.24867 | 1 |
| 0.24868 | 1 |
| 0.24869 | 1 |
| 0.2487 | 1 |
| 0.24871 | 1 |
| 0.24872 | 1 |
| 0.24873 | 1 |
| 0.24874 | 1 |
| 0.24875 | 1 |
| 0.24876 | 1 |
| 0.24877 | 1 |
| 0.24878 | 1 |
| 0.24879 | 1 |
| 0.2488 | 1 |
| 0.24881 | 1 |
| 0.24882 | 1 |
| 0.24883 | 1 |
| 0.24884 | 1 |
| 0.24885 | 1 |
| 0.24886 | 1 |
| 0.24887 | 1 |
| 0.24888 | 1 |
| 0.24889 | 1 |
| 0.2489 | 1 |
| 0.24891 | 1 |
| 0.24892 | 1 |
| 0.24893 | 1 |
| 0.24894 | 1 |
| 0.24895 | 1 |
| 0.24896 | 1 |
| 0.24897 | 1 |
| 0.24898 | 1 |
| 0.24899 | 1 |
| 0.249 | 1 |
| 0.24901 | 1 |
| 0.24902 | 1 |
| 0.24903 | 1 |
| 0.24904 | 1 |
| 0.24905 | 1 |
| 0.24906 | 1 |
| 0.24907 | 1 |
| 0.24908 | 1 |
| 0.24909 | 1 |
| 0.2491 | 1 |
| 0.24911 | 1 |
| 0.24912 | 1 |
| 0.24913 | 1 |
| 0.24914 | 1 |
| 0.24915 | 1 |
| 0.24916 | 1 |
| 0.24917 | 1 |
| 0.24918 | 1 |
| 0.24919 | 1 |
| 0.2492 | 1 |
| 0.24921 | 1 |
| 0.24922 | 1 |
| 0.24923 | 1 |
| 0.24924 | 1 |
| 0.24925 | 1 |
| 0.24926 | 1 |
| 0.24927 | 1 |
| 0.24928 | 1 |
| 0.24929 | 1 |
| 0.2493 | 1 |
| 0.24931 | 1 |
| 0.24932 | 1 |
| 0.24933 | 1 |
| 0.24934 | 1 |
| 0.24935 | 1 |
| 0.24936 | 1 |
| 0.24937 | 1 |
| 0.24938 | 1 |
| 0.24939 | 1 |
| 0.2494 | 1 |
| 0.24941 | 1 |
| 0.24942 | 1 |
| 0.24943 | 1 |
| 0.24944 | 1 |
| 0.24945 | 1 |
| 0.24946 | 1 |
| 0.24947 | 1 |
| 0.24948 | 1 |
| 0.24949 | 1 |
| 0.2495 | 1 |
| 0.24951 | 1 |
| 0.24952 | 1 |
| 0.24953 | 1 |
| 0.24954 | 1 |
| 0.24955 | 1 |
| 0.24956 | 1 |
| 0.24957 | 1 |
| 0.24958 | 1 |
| 0.24959 | 1 |
| 0.2496 | 1 |
| 0.24961 | 1 |
| 0.24962 | 1 |
| 0.24963 | 1 |
| 0.24964 | 1 |
| 0.24965 | 1 |
| 0.24966 | 1 |
| 0.24967 | 1 |
| 0.24968 | 1 |
| 0.24969 | 1 |
| 0.2497 | 1 |
| 0.24971 | 1 |
| 0.24972 | 1 |
| 0.24973 | 1 |
| 0.24974 | 1 |
| 0.24975 | 1 |
| 0.24976 | 1 |
| 0.24977 | 1 |
| 0.24978 | 1 |
| 0.24979 | 1 |
| 0.2498 | 1 |
| 0.24981 | 1 |
| 0.24982 | 1 |
| 0.24983 | 1 |
| 0.24984 | 1 |
| 0.24985 | 1 |
| 0.24986 | 1 |
| 0.24987 | 1 |
| 0.24988 | 1 |
| 0.24989 | 1 |
| 0.2499 | 1 |
| 0.24991 | 1 |
| 0.24992 | 1 |
| 0.24993 | 1 |
| 0.24994 | 1 |
| 0.24995 | 1 |
| 0.24996 | 1 |
| 0.24997 | 1 |
| 0.24998 | 1 |
| 0.24999 | 1 |
| 0.25 | 1 |
| 0.25001 | 1 |
| 0.25002 | 1 |
| 0.25003 | 1 |
| 0.25004 | 1 |
| 0.25005 | 1 |
| 0.25006 | 1 |
| 0.25007 | 1 |
| 0.25008 | 1 |
| 0.25009 | 1 |
| 0.2501 | 1 |
| 0.25011 | 1 |
| 0.25012 | 1 |
| 0.25013 | 1 |
| 0.25014 | 1 |
| 0.25015 | 1 |
| 0.25016 | 1 |
| 0.25017 | 1 |
| 0.25018 | 1 |
| 0.25019 | 1 |
| 0.2502 | 1 |
| 0.25021 | 1 |
| 0.25022 | 1 |
| 0.25023 | 1 |
| 0.25024 | 1 |
| 0.25025 | 1 |
| 0.25026 | 1 |
| 0.25027 | 1 |
| 0.25028 | 1 |
| 0.25029 | 1 |
| 0.2503 | 1 |
| 0.25031 | 1 |
| 0.25032 | 1 |
| 0.25033 | 1 |
| 0.25034 | 1 |
| 0.25035 | 1 |
| 0.25036 | 1 |
| 0.25037 | 1 |
| 0.25038 | 1 |
| 0.25039 | 1 |
| 0.2504 | 1 |
| 0.25041 | 1 |
| 0.25042 | 1 |
| 0.25043 | 1 |
| 0.25044 | 1 |
| 0.25045 | 1 |
| 0.25046 | 1 |
| 0.25047 | 1 |
| 0.25048 | 1 |
| 0.25049 | 1 |
| 0.2505 | 1 |
| 0.25051 | 1 |
| 0.25052 | 1 |
| 0.25053 | 1 |
| 0.25054 | 1 |
| 0.25055 | 1 |
| 0.25056 | 1 |
| 0.25057 | 1 |
| 0.25058 | 1 |
| 0.25059 | 1 |
| 0.2506 | 1 |
| 0.25061 | 1 |
| 0.25062 | 1 |
| 0.25063 | 1 |
| 0.25064 | 1 |
| 0.25065 | 1 |
| 0.25066 | 1 |
| 0.25067 | 1 |
| 0.25068 | 1 |
| 0.25069 | 1 |
| 0.2507 | 1 |
| 0.25071 | 1 |
| 0.25072 | 1 |
| 0.25073 | 1 |
| 0.25074 | 1 |
| 0.25075 | 1 |
| 0.25076 | 1 |
| 0.25077 | 1 |
| 0.25078 | 1 |
| 0.25079 | 1 |
| 0.2508 | 1 |
| 0.25081 | 1 |
| 0.25082 | 1 |
| 0.25083 | 1 |
| 0.25084 | 1 |
| 0.25085 | 1 |
| 0.25086 | 1 |
| 0.25087 | 1 |
| 0.25088 | 1 |
| 0.25089 | 1 |
| 0.2509 | 1 |
| 0.25091 | 1 |
| 0.25092 | 1 |
| 0.25093 | 1 |
| 0.25094 | 1 |
| 0.25095 | 1 |
| 0.25096 | 1 |
| 0.25097 | 1 |
| 0.25098 | 1 |
| 0.25099 | 1 |
| 0.251 | 1 |
| 0.25101 | 1 |
| 0.25102 | 1 |
| 0.25103 | 1 |
| 0.25104 | 1 |
| 0.25105 | 1 |
| 0.25106 | 1 |
| 0.25107 | 1 |
| 0.25108 | 1 |
| 0.25109 | 1 |
| 0.2511 | 1 |
| 0.25111 | 1 |
| 0.25112 | 1 |
| 0.25113 | 1 |
| 0.25114 | 1 |
| 0.25115 | 1 |
| 0.25116 | 1 |
| 0.25117 | 1 |
| 0.25118 | 1 |
| 0.25119 | 1 |
| 0.2512 | 1 |
| 0.25121 | 1 |
| 0.25122 | 1 |
| 0.25123 | 1 |
| 0.25124 | 1 |
| 0.25125 | 1 |
| 0.25126 | 1 |
| 0.25127 | 1 |
| 0.25128 | 1 |
| 0.25129 | 1 |
| 0.2513 | 1 |
| 0.25131 | 1 |
| 0.25132 | 1 |
| 0.25133 | 1 |
| 0.25134 | 1 |
| 0.25135 | 1 |
| 0.25136 | 1 |
| 0.25137 | 1 |
| 0.25138 | 1 |
| 0.25139 | 1 |
| 0.2514 | 1 |
| 0.25141 | 1 |
| 0.25142 | 1 |
| 0.25143 | 1 |
| 0.25144 | 1 |
| 0.25145 | 1 |
| 0.25146 | 1 |
| 0.25147 | 1 |
| 0.25148 | 1 |
| 0.25149 | 1 |
| 0.2515 | 1 |
| 0.25151 | 1 |
| 0.25152 | 1 |
| 0.25153 | 1 |
| 0.25154 | 1 |
| 0.25155 | 1 |
| 0.25156 | 1 |
| 0.25157 | 1 |
| 0.25158 | 1 |
| 0.25159 | 1 |
| 0.2516 | 1 |
| 0.25161 | 1 |
| 0.25162 | 1 |
| 0.25163 | 1 |
| 0.25164 | 1 |
| 0.25165 | 1 |
| 0.25166 | 1 |
| 0.25167 | 1 |
| 0.25168 | 1 |
| 0.25169 | 1 |
| 0.2517 | 1 |
| 0.25171 | 1 |
| 0.25172 | 1 |
| 0.25173 | 1 |
| 0.25174 | 1 |
| 0.25175 | 1 |
| 0.25176 | 1 |
| 0.25177 | 1 |
| 0.25178 | 1 |
| 0.25179 | 1 |
| 0.2518 | 1 |
| 0.25181 | 1 |
| 0.25182 | 1 |
| 0.25183 | 1 |
| 0.25184 | 1 |
| 0.25185 | 1 |
| 0.25186 | 1 |
| 0.25187 | 1 |
| 0.25188 | 1 |
| 0.25189 | 1 |
| 0.2519 | 1 |
| 0.25191 | 1 |
| 0.25192 | 1 |
| 0.25193 | 1 |
| 0.25194 | 1 |
| 0.25195 | 1 |
| 0.25196 | 1 |
| 0.25197 | 1 |
| 0.25198 | 1 |
| 0.25199 | 1 |
| 0.252 | 1 |
| 0.25201 | 1 |
| 0.25202 | 1 |
| 0.25203 | 1 |
| 0.25204 | 1 |
| 0.25205 | 1 |
| 0.25206 | 1 |
| 0.25207 | 1 |
| 0.25208 | 1 |
| 0.25209 | 1 |
| 0.2521 | 1 |
| 0.25211 | 1 |
| 0.25212 | 1 |
| 0.25213 | 1 |
| 0.25214 | 1 |
| 0.25215 | 1 |
| 0.25216 | 1 |
| 0.25217 | 1 |
| 0.25218 | 1 |
| 0.25219 | 1 |
| 0.2522 | 1 |
| 0.25221 | 1 |
| 0.25222 | 1 |
| 0.25223 | 1 |
| 0.25224 | 1 |
| 0.25225 | 1 |
| 0.25226 | 1 |
| 0.25227 | 1 |
| 0.25228 | 1 |
| 0.25229 | 1 |
| 0.2523 | 1 |
| 0.25231 | 1 |
| 0.25232 | 1 |
| 0.25233 | 1 |
| 0.25234 | 1 |
| 0.25235 | 1 |
| 0.25236 | 1 |
| 0.25237 | 1 |
| 0.25238 | 1 |
| 0.25239 | 1 |
| 0.2524 | 1 |
| 0.25241 | 1 |
| 0.25242 | 1 |
| 0.25243 | 1 |
| 0.25244 | 1 |
| 0.25245 | 1 |
| 0.25246 | 1 |
| 0.25247 | 1 |
| 0.25248 | 1 |
| 0.25249 | 1 |
| 0.2525 | 1 |
| 0.25251 | 1 |
| 0.25252 | 1 |
| 0.25253 | 1 |
| 0.25254 | 1 |
| 0.25255 | 1 |
| 0.25256 | 1 |
| 0.25257 | 1 |
| 0.25258 | 1 |
| 0.25259 | 1 |
| 0.2526 | 1 |
| 0.25261 | 1 |
| 0.25262 | 1 |
| 0.25263 | 1 |
| 0.25264 | 1 |
| 0.25265 | 1 |
| 0.25266 | 1 |
| 0.25267 | 1 |
| 0.25268 | 1 |
| 0.25269 | 1 |
| 0.2527 | 1 |
| 0.25271 | 1 |
| 0.25272 | 1 |
| 0.25273 | 1 |
| 0.25274 | 1 |
| 0.25275 | 1 |
| 0.25276 | 1 |
| 0.25277 | 1 |
| 0.25278 | 1 |
| 0.25279 | 1 |
| 0.2528 | 1 |
| 0.25281 | 1 |
| 0.25282 | 1 |
| 0.25283 | 1 |
| 0.25284 | 1 |
| 0.25285 | 1 |
| 0.25286 | 1 |
| 0.25287 | 1 |
| 0.25288 | 1 |
| 0.25289 | 1 |
| 0.2529 | 1 |
| 0.25291 | 1 |
| 0.25292 | 1 |
| 0.25293 | 1 |
| 0.25294 | 1 |
| 0.25295 | 1 |
| 0.25296 | 1 |
| 0.25297 | 1 |
| 0.25298 | 1 |
| 0.25299 | 1 |
| 0.253 | 1 |
| 0.25301 | 1 |
| 0.25302 | 1 |
| 0.25303 | 1 |
| 0.25304 | 1 |
| 0.25305 | 1 |
| 0.25306 | 1 |
| 0.25307 | 1 |
| 0.25308 | 1 |
| 0.25309 | 1 |
| 0.2531 | 1 |
| 0.25311 | 1 |
| 0.25312 | 1 |
| 0.25313 | 1 |
| 0.25314 | 1 |
| 0.25315 | 1 |
| 0.25316 | 1 |
| 0.25317 | 1 |
| 0.25318 | 1 |
| 0.25319 | 1 |
| 0.2532 | 1 |
| 0.25321 | 1 |
| 0.25322 | 1 |
| 0.25323 | 1 |
| 0.25324 | 1 |
| 0.25325 | 1 |
| 0.25326 | 1 |
| 0.25327 | 1 |
| 0.25328 | 1 |
| 0.25329 | 1 |
| 0.2533 | 1 |
| 0.25331 | 1 |
| 0.25332 | 1 |
| 0.25333 | 1 |
| 0.25334 | 1 |
| 0.25335 | 1 |
| 0.25336 | 1 |
| 0.25337 | 1 |
| 0.25338 | 1 |
| 0.25339 | 1 |
| 0.2534 | 1 |
| 0.25341 | 1 |
| 0.25342 | 1 |
| 0.25343 | 1 |
| 0.25344 | 1 |
| 0.25345 | 1 |
| 0.25346 | 1 |
| 0.25347 | 1 |
| 0.25348 | 1 |
| 0.25349 | 1 |
| 0.2535 | 1 |
| 0.25351 | 1 |
| 0.25352 | 1 |
| 0.25353 | 1 |
| 0.25354 | 1 |
| 0.25355 | 1 |
| 0.25356 | 1 |
| 0.25357 | 1 |
| 0.25358 | 1 |
| 0.25359 | 1 |
| 0.2536 | 1 |
| 0.25361 | 1 |
| 0.25362 | 1 |
| 0.25363 | 1 |
| 0.25364 | 1 |
| 0.25365 | 1 |
| 0.25366 | 1 |
| 0.25367 | 1 |
| 0.25368 | 1 |
| 0.25369 | 1 |
| 0.2537 | 1 |
| 0.25371 | 1 |
| 0.25372 | 1 |
| 0.25373 | 1 |
| 0.25374 | 1 |
| 0.25375 | 1 |
| 0.25376 | 1 |
| 0.25377 | 1 |
| 0.25378 | 1 |
| 0.25379 | 1 |
| 0.2538 | 1 |
| 0.25381 | 1 |
| 0.25382 | 1 |
| 0.25383 | 1 |
| 0.25384 | 1 |
| 0.25385 | 1 |
| 0.25386 | 1 |
| 0.25387 | 1 |
| 0.25388 | 1 |
| 0.25389 | 1 |
| 0.2539 | 1 |
| 0.25391 | 1 |
| 0.25392 | 1 |
| 0.25393 | 1 |
| 0.25394 | 1 |
| 0.25395 | 1 |
| 0.25396 | 1 |
| 0.25397 | 1 |
| 0.25398 | 1 |
| 0.25399 | 1 |
| 0.254 | 1 |
| 0.25401 | 1 |
| 0.25402 | 1 |
| 0.25403 | 1 |
| 0.25404 | 1 |
| 0.25405 | 1 |
| 0.25406 | 1 |
| 0.25407 | 1 |
| 0.25408 | 1 |
| 0.25409 | 1 |
| 0.2541 | 1 |
| 0.25411 | 1 |
| 0.25412 | 1 |
| 0.25413 | 1 |
| 0.25414 | 1 |
| 0.25415 | 1 |
| 0.25416 | 1 |
| 0.25417 | 1 |
| 0.25418 | 1 |
| 0.25419 | 1 |
| 0.2542 | 1 |
| 0.25421 | 1 |
| 0.25422 | 1 |
| 0.25423 | 1 |
| 0.25424 | 1 |
| 0.25425 | 1 |
| 0.25426 | 1 |
| 0.25427 | 1 |
| 0.25428 | 1 |
| 0.25429 | 1 |
| 0.2543 | 1 |
| 0.25431 | 1 |
| 0.25432 | 1 |
| 0.25433 | 1 |
| 0.25434 | 1 |
| 0.25435 | 1 |
| 0.25436 | 1 |
| 0.25437 | 1 |
| 0.25438 | 1 |
| 0.25439 | 1 |
| 0.2544 | 1 |
| 0.25441 | 1 |
| 0.25442 | 1 |
| 0.25443 | 1 |
| 0.25444 | 1 |
| 0.25445 | 1 |
| 0.25446 | 1 |
| 0.25447 | 1 |
| 0.25448 | 1 |
| 0.25449 | 1 |
| 0.2545 | 1 |
| 0.25451 | 1 |
| 0.25452 | 1 |
| 0.25453 | 1 |
| 0.25454 | 1 |
| 0.25455 | 1 |
| 0.25456 | 1 |
| 0.25457 | 1 |
| 0.25458 | 1 |
| 0.25459 | 1 |
| 0.2546 | 1 |
| 0.25461 | 1 |
| 0.25462 | 1 |
| 0.25463 | 1 |
| 0.25464 | 1 |
| 0.25465 | 1 |
| 0.25466 | 1 |
| 0.25467 | 1 |
| 0.25468 | 1 |
| 0.25469 | 1 |
| 0.2547 | 1 |
| 0.25471 | 1 |
| 0.25472 | 1 |
| 0.25473 | 1 |
| 0.25474 | 1 |
| 0.25475 | 1 |
| 0.25476 | 1 |
| 0.25477 | 1 |
| 0.25478 | 1 |
| 0.25479 | 1 |
| 0.2548 | 1 |
| 0.25481 | 1 |
| 0.25482 | 1 |
| 0.25483 | 1 |
| 0.25484 | 1 |
| 0.25485 | 1 |
| 0.25486 | 1 |
| 0.25487 | 1 |
| 0.25488 | 1 |
| 0.25489 | 1 |
| 0.2549 | 1 |
| 0.25491 | 1 |
| 0.25492 | 1 |
| 0.25493 | 1 |
| 0.25494 | 1 |
| 0.25495 | 1 |
| 0.25496 | 1 |
| 0.25497 | 1 |
| 0.25498 | 1 |
| 0.25499 | 1 |
| 0.255 | 1 |
| 0.25501 | 1 |
| 0.25502 | 1 |
| 0.25503 | 1 |
| 0.25504 | 1 |
| 0.25505 | 1 |
| 0.25506 | 1 |
| 0.25507 | 1 |
| 0.25508 | 1 |
| 0.25509 | 1 |
| 0.2551 | 1 |
| 0.25511 | 1 |
| 0.25512 | 1 |
| 0.25513 | 1 |
| 0.25514 | 1 |
| 0.25515 | 1 |
| 0.25516 | 1 |
| 0.25517 | 1 |
| 0.25518 | 1 |
| 0.25519 | 1 |
| 0.2552 | 1 |
| 0.25521 | 1 |
| 0.25522 | 1 |
| 0.25523 | 1 |
| 0.25524 | 1 |
| 0.25525 | 1 |
| 0.25526 | 1 |
| 0.25527 | 1 |
| 0.25528 | 1 |
| 0.25529 | 1 |
| 0.2553 | 1 |
| 0.25531 | 1 |
| 0.25532 | 1 |
| 0.25533 | 1 |
| 0.25534 | 1 |
| 0.25535 | 1 |
| 0.25536 | 1 |
| 0.25537 | 1 |
| 0.25538 | 1 |
| 0.25539 | 1 |
| 0.2554 | 1 |
| 0.25541 | 1 |
| 0.25542 | 1 |
| 0.25543 | 1 |
| 0.25544 | 1 |
| 0.25545 | 1 |
| 0.25546 | 1 |
| 0.25547 | 1 |
| 0.25548 | 1 |
| 0.25549 | 1 |
| 0.2555 | 1 |
| 0.25551 | 1 |
| 0.25552 | 1 |
| 0.25553 | 1 |
| 0.25554 | 1 |
| 0.25555 | 1 |
| 0.25556 | 1 |
| 0.25557 | 1 |
| 0.25558 | 1 |
| 0.25559 | 1 |
| 0.2556 | 1 |
| 0.25561 | 1 |
| 0.25562 | 1 |
| 0.25563 | 1 |
| 0.25564 | 1 |
| 0.25565 | 1 |
| 0.25566 | 1 |
| 0.25567 | 1 |
| 0.25568 | 1 |
| 0.25569 | 1 |
| 0.2557 | 1 |
| 0.25571 | 1 |
| 0.25572 | 1 |
| 0.25573 | 1 |
| 0.25574 | 1 |
| 0.25575 | 1 |
| 0.25576 | 1 |
| 0.25577 | 1 |
| 0.25578 | 1 |
| 0.25579 | 1 |
| 0.2558 | 1 |
| 0.25581 | 1 |
| 0.25582 | 1 |
| 0.25583 | 1 |
| 0.25584 | 1 |
| 0.25585 | 1 |
| 0.25586 | 1 |
| 0.25587 | 1 |
| 0.25588 | 1 |
| 0.25589 | 1 |
| 0.2559 | 1 |
| 0.25591 | 1 |
| 0.25592 | 1 |
| 0.25593 | 1 |
| 0.25594 | 1 |
| 0.25595 | 1 |
| 0.25596 | 1 |
| 0.25597 | 1 |
| 0.25598 | 1 |
| 0.25599 | 1 |
| 0.256 | 1 |
| 0.25601 | 1 |
| 0.25602 | 1 |
| 0.25603 | 1 |
| 0.25604 | 1 |
| 0.25605 | 1 |
| 0.25606 | 1 |
| 0.25607 | 1 |
| 0.25608 | 1 |
| 0.25609 | 1 |
| 0.2561 | 1 |
| 0.25611 | 1 |
| 0.25612 | 1 |
| 0.25613 | 1 |
| 0.25614 | 1 |
| 0.25615 | 1 |
| 0.25616 | 1 |
| 0.25617 | 1 |
| 0.25618 | 1 |
| 0.25619 | 1 |
| 0.2562 | 1 |
| 0.25621 | 1 |
| 0.25622 | 1 |
| 0.25623 | 1 |
| 0.25624 | 1 |
| 0.25625 | 1 |
| 0.25626 | 1 |
| 0.25627 | 1 |
| 0.25628 | 1 |
| 0.25629 | 1 |
| 0.2563 | 1 |
| 0.25631 | 1 |
| 0.25632 | 1 |
| 0.25633 | 1 |
| 0.25634 | 1 |
| 0.25635 | 1 |
| 0.25636 | 1 |
| 0.25637 | 1 |
| 0.25638 | 1 |
| 0.25639 | 1 |
| 0.2564 | 1 |
| 0.25641 | 1 |
| 0.25642 | 1 |
| 0.25643 | 1 |
| 0.25644 | 1 |
| 0.25645 | 1 |
| 0.25646 | 1 |
| 0.25647 | 1 |
| 0.25648 | 1 |
| 0.25649 | 1 |
| 0.2565 | 1 |
| 0.25651 | 1 |
| 0.25652 | 1 |
| 0.25653 | 1 |
| 0.25654 | 1 |
| 0.25655 | 1 |
| 0.25656 | 1 |
| 0.25657 | 1 |
| 0.25658 | 1 |
| 0.25659 | 1 |
| 0.2566 | 1 |
| 0.25661 | 1 |
| 0.25662 | 1 |
| 0.25663 | 1 |
| 0.25664 | 1 |
| 0.25665 | 1 |
| 0.25666 | 1 |
| 0.25667 | 1 |
| 0.25668 | 1 |
| 0.25669 | 1 |
| 0.2567 | 1 |
| 0.25671 | 1 |
| 0.25672 | 1 |
| 0.25673 | 1 |
| 0.25674 | 1 |
| 0.25675 | 1 |
| 0.25676 | 1 |
| 0.25677 | 1 |
| 0.25678 | 1 |
| 0.25679 | 1 |
| 0.2568 | 1 |
| 0.25681 | 1 |
| 0.25682 | 1 |
| 0.25683 | 1 |
| 0.25684 | 1 |
| 0.25685 | 1 |
| 0.25686 | 1 |
| 0.25687 | 1 |
| 0.25688 | 1 |
| 0.25689 | 1 |
| 0.2569 | 1 |
| 0.25691 | 1 |
| 0.25692 | 1 |
| 0.25693 | 1 |
| 0.25694 | 1 |
| 0.25695 | 1 |
| 0.25696 | 1 |
| 0.25697 | 1 |
| 0.25698 | 1 |
| 0.25699 | 1 |
| 0.257 | 1 |
| 0.25701 | 1 |
| 0.25702 | 1 |
| 0.25703 | 1 |
| 0.25704 | 1 |
| 0.25705 | 1 |
| 0.25706 | 1 |
| 0.25707 | 1 |
| 0.25708 | 1 |
| 0.25709 | 1 |
| 0.2571 | 1 |
| 0.25711 | 1 |
| 0.25712 | 1 |
| 0.25713 | 1 |
| 0.25714 | 1 |
| 0.25715 | 1 |
| 0.25716 | 1 |
| 0.25717 | 1 |
| 0.25718 | 1 |
| 0.25719 | 1 |
| 0.2572 | 1 |
| 0.25721 | 1 |
| 0.25722 | 1 |
| 0.25723 | 1 |
| 0.25724 | 1 |
| 0.25725 | 1 |
| 0.25726 | 1 |
| 0.25727 | 1 |
| 0.25728 | 1 |
| 0.25729 | 1 |
| 0.2573 | 1 |
| 0.25731 | 1 |
| 0.25732 | 1 |
| 0.25733 | 1 |
| 0.25734 | 1 |
| 0.25735 | 1 |
| 0.25736 | 1 |
| 0.25737 | 1 |
| 0.25738 | 1 |
| 0.25739 | 1 |
| 0.2574 | 1 |
| 0.25741 | 1 |
| 0.25742 | 1 |
| 0.25743 | 1 |
| 0.25744 | 1 |
| 0.25745 | 1 |
| 0.25746 | 1 |
| 0.25747 | 1 |
| 0.25748 | 1 |
| 0.25749 | 1 |
| 0.2575 | 1 |
| 0.25751 | 1 |
| 0.25752 | 1 |
| 0.25753 | 1 |
| 0.25754 | 1 |
| 0.25755 | 1 |
| 0.25756 | 1 |
| 0.25757 | 1 |
| 0.25758 | 1 |
| 0.25759 | 1 |
| 0.2576 | 1 |
| 0.25761 | 1 |
| 0.25762 | 1 |
| 0.25763 | 1 |
| 0.25764 | 1 |
| 0.25765 | 1 |
| 0.25766 | 1 |
| 0.25767 | 1 |
| 0.25768 | 1 |
| 0.25769 | 1 |
| 0.2577 | 1 |
| 0.25771 | 1 |
| 0.25772 | 1 |
| 0.25773 | 1 |
| 0.25774 | 1 |
| 0.25775 | 1 |
| 0.25776 | 1 |
| 0.25777 | 1 |
| 0.25778 | 1 |
| 0.25779 | 1 |
| 0.2578 | 1 |
| 0.25781 | 1 |
| 0.25782 | 1 |
| 0.25783 | 1 |
| 0.25784 | 1 |
| 0.25785 | 1 |
| 0.25786 | 1 |
| 0.25787 | 1 |
| 0.25788 | 1 |
| 0.25789 | 1 |
| 0.2579 | 1 |
| 0.25791 | 1 |
| 0.25792 | 1 |
| 0.25793 | 1 |
| 0.25794 | 1 |
| 0.25795 | 1 |
| 0.25796 | 1 |
| 0.25797 | 1 |
| 0.25798 | 1 |
| 0.25799 | 1 |
| 0.258 | 1 |
| 0.25801 | 1 |
| 0.25802 | 1 |
| 0.25803 | 1 |
| 0.25804 | 1 |
| 0.25805 | 1 |
| 0.25806 | 1 |
| 0.25807 | 1 |
| 0.25808 | 1 |
| 0.25809 | 1 |
| 0.2581 | 1 |
| 0.25811 | 1 |
| 0.25812 | 1 |
| 0.25813 | 1 |
| 0.25814 | 1 |
| 0.25815 | 1 |
| 0.25816 | 1 |
| 0.25817 | 1 |
| 0.25818 | 1 |
| 0.25819 | 1 |
| 0.2582 | 1 |
| 0.25821 | 1 |
| 0.25822 | 1 |
| 0.25823 | 1 |
| 0.25824 | 1 |
| 0.25825 | 1 |
| 0.25826 | 1 |
| 0.25827 | 1 |
| 0.25828 | 1 |
| 0.25829 | 1 |
| 0.2583 | 1 |
| 0.25831 | 1 |
| 0.25832 | 1 |
| 0.25833 | 1 |
| 0.25834 | 1 |
| 0.25835 | 1 |
| 0.25836 | 1 |
| 0.25837 | 1 |
| 0.25838 | 1 |
| 0.25839 | 1 |
| 0.2584 | 1 |
| 0.25841 | 1 |
| 0.25842 | 1 |
| 0.25843 | 1 |
| 0.25844 | 1 |
| 0.25845 | 1 |
| 0.25846 | 1 |
| 0.25847 | 1 |
| 0.25848 | 1 |
| 0.25849 | 1 |
| 0.2585 | 1 |
| 0.25851 | 1 |
| 0.25852 | 1 |
| 0.25853 | 1 |
| 0.25854 | 1 |
| 0.25855 | 1 |
| 0.25856 | 1 |
| 0.25857 | 1 |
| 0.25858 | 1 |
| 0.25859 | 1 |
| 0.2586 | 1 |
| 0.25861 | 1 |
| 0.25862 | 1 |
| 0.25863 | 1 |
| 0.25864 | 1 |
| 0.25865 | 1 |
| 0.25866 | 1 |
| 0.25867 | 1 |
| 0.25868 | 1 |
| 0.25869 | 1 |
| 0.2587 | 1 |
| 0.25871 | 1 |
| 0.25872 | 1 |
| 0.25873 | 1 |
| 0.25874 | 1 |
| 0.25875 | 1 |
| 0.25876 | 1 |
| 0.25877 | 1 |
| 0.25878 | 1 |
| 0.25879 | 1 |
| 0.2588 | 1 |
| 0.25881 | 1 |
| 0.25882 | 1 |
| 0.25883 | 1 |
| 0.25884 | 1 |
| 0.25885 | 1 |
| 0.25886 | 1 |
| 0.25887 | 1 |
| 0.25888 | 1 |
| 0.25889 | 1 |
| 0.2589 | 1 |
| 0.25891 | 1 |
| 0.25892 | 1 |
| 0.25893 | 1 |
| 0.25894 | 1 |
| 0.25895 | 1 |
| 0.25896 | 1 |
| 0.25897 | 1 |
| 0.25898 | 1 |
| 0.25899 | 1 |
| 0.259 | 1 |
| 0.25901 | 1 |
| 0.25902 | 1 |
| 0.25903 | 1 |
| 0.25904 | 1 |
| 0.25905 | 1 |
| 0.25906 | 1 |
| 0.25907 | 1 |
| 0.25908 | 1 |
| 0.25909 | 1 |
| 0.2591 | 1 |
| 0.25911 | 1 |
| 0.25912 | 1 |
| 0.25913 | 1 |
| 0.25914 | 1 |
| 0.25915 | 1 |
| 0.25916 | 1 |
| 0.25917 | 1 |
| 0.25918 | 1 |
| 0.25919 | 1 |
| 0.2592 | 1 |
| 0.25921 | 1 |
| 0.25922 | 1 |
| 0.25923 | 1 |
| 0.25924 | 1 |
| 0.25925 | 1 |
| 0.25926 | 1 |
| 0.25927 | 1 |
| 0.25928 | 1 |
| 0.25929 | 1 |
| 0.2593 | 1 |
| 0.25931 | 1 |
| 0.25932 | 1 |
| 0.25933 | 1 |
| 0.25934 | 1 |
| 0.25935 | 1 |
| 0.25936 | 1 |
| 0.25937 | 1 |
| 0.25938 | 1 |
| 0.25939 | 1 |
| 0.2594 | 1 |
| 0.25941 | 1 |
| 0.25942 | 1 |
| 0.25943 | 1 |
| 0.25944 | 1 |
| 0.25945 | 1 |
| 0.25946 | 1 |
| 0.25947 | 1 |
| 0.25948 | 1 |
| 0.25949 | 1 |
| 0.2595 | 1 |
| 0.25951 | 1 |
| 0.25952 | 1 |
| 0.25953 | 1 |
| 0.25954 | 1 |
| 0.25955 | 1 |
| 0.25956 | 1 |
| 0.25957 | 1 |
| 0.25958 | 1 |
| 0.25959 | 1 |
| 0.2596 | 1 |
| 0.25961 | 1 |
| 0.25962 | 1 |
| 0.25963 | 1 |
| 0.25964 | 1 |
| 0.25965 | 1 |
| 0.25966 | 1 |
| 0.25967 | 1 |
| 0.25968 | 1 |
| 0.25969 | 1 |
| 0.2597 | 1 |
| 0.25971 | 1 |
| 0.25972 | 1 |
| 0.25973 | 1 |
| 0.25974 | 1 |
| 0.25975 | 1 |
| 0.25976 | 1 |
| 0.25977 | 1 |
| 0.25978 | 1 |
| 0.25979 | 1 |
| 0.2598 | 1 |
| 0.25981 | 1 |
| 0.25982 | 1 |
| 0.25983 | 1 |
| 0.25984 | 1 |
| 0.25985 | 1 |
| 0.25986 | 1 |
| 0.25987 | 1 |
| 0.25988 | 1 |
| 0.25989 | 1 |
| 0.2599 | 1 |
| 0.25991 | 1 |
| 0.25992 | 1 |
| 0.25993 | 1 |
| 0.25994 | 1 |
| 0.25995 | 1 |
| 0.25996 | 1 |
| 0.25997 | 1 |
| 0.25998 | 1 |
| 0.25999 | 1 |
| 0.26 | 1 |
| 0.26001 | 1 |
| 0.26002 | 1 |
| 0.26003 | 1 |
| 0.26004 | 1 |
| 0.26005 | 1 |
| 0.26006 | 1 |
| 0.26007 | 1 |
| 0.26008 | 1 |
| 0.26009 | 1 |
| 0.2601 | 1 |
| 0.26011 | 1 |
| 0.26012 | 1 |
| 0.26013 | 1 |
| 0.26014 | 1 |
| 0.26015 | 1 |
| 0.26016 | 1 |
| 0.26017 | 1 |
| 0.26018 | 1 |
| 0.26019 | 1 |
| 0.2602 | 1 |
| 0.26021 | 1 |
| 0.26022 | 1 |
| 0.26023 | 1 |
| 0.26024 | 1 |
| 0.26025 | 1 |
| 0.26026 | 1 |
| 0.26027 | 1 |
| 0.26028 | 1 |
| 0.26029 | 1 |
| 0.2603 | 1 |
| 0.26031 | 1 |
| 0.26032 | 1 |
| 0.26033 | 1 |
| 0.26034 | 1 |
| 0.26035 | 1 |
| 0.26036 | 1 |
| 0.26037 | 1 |
| 0.26038 | 1 |
| 0.26039 | 1 |
| 0.2604 | 1 |
| 0.26041 | 1 |
| 0.26042 | 1 |
| 0.26043 | 1 |
| 0.26044 | 1 |
| 0.26045 | 1 |
| 0.26046 | 1 |
| 0.26047 | 1 |
| 0.26048 | 1 |
| 0.26049 | 1 |
| 0.2605 | 1 |
| 0.26051 | 1 |
| 0.26052 | 1 |
| 0.26053 | 1 |
| 0.26054 | 1 |
| 0.26055 | 1 |
| 0.26056 | 1 |
| 0.26057 | 1 |
| 0.26058 | 1 |
| 0.26059 | 1 |
| 0.2606 | 1 |
| 0.26061 | 1 |
| 0.26062 | 1 |
| 0.26063 | 1 |
| 0.26064 | 1 |
| 0.26065 | 1 |
| 0.26066 | 1 |
| 0.26067 | 1 |
| 0.26068 | 1 |
| 0.26069 | 1 |
| 0.2607 | 1 |
| 0.26071 | 1 |
| 0.26072 | 1 |
| 0.26073 | 1 |
| 0.26074 | 1 |
| 0.26075 | 1 |
| 0.26076 | 1 |
| 0.26077 | 1 |
| 0.26078 | 1 |
| 0.26079 | 1 |
| 0.2608 | 1 |
| 0.26081 | 1 |
| 0.26082 | 1 |
| 0.26083 | 1 |
| 0.26084 | 1 |
| 0.26085 | 1 |
| 0.26086 | 1 |
| 0.26087 | 1 |
| 0.26088 | 1 |
| 0.26089 | 1 |
| 0.2609 | 1 |
| 0.26091 | 1 |
| 0.26092 | 1 |
| 0.26093 | 1 |
| 0.26094 | 1 |
| 0.26095 | 1 |
| 0.26096 | 1 |
| 0.26097 | 1 |
| 0.26098 | 1 |
| 0.26099 | 1 |
| 0.261 | 1 |
| 0.26101 | 1 |
| 0.26102 | 1 |
| 0.26103 | 1 |
| 0.26104 | 1 |
| 0.26105 | 1 |
| 0.26106 | 1 |
| 0.26107 | 1 |
| 0.26108 | 1 |
| 0.26109 | 1 |
| 0.2611 | 1 |
| 0.26111 | 1 |
| 0.26112 | 1 |
| 0.26113 | 1 |
| 0.26114 | 1 |
| 0.26115 | 1 |
| 0.26116 | 1 |
| 0.26117 | 1 |
| 0.26118 | 1 |
| 0.26119 | 1 |
| 0.2612 | 1 |
| 0.26121 | 1 |
| 0.26122 | 1 |
| 0.26123 | 1 |
| 0.26124 | 1 |
| 0.26125 | 1 |
| 0.26126 | 1 |
| 0.26127 | 1 |
| 0.26128 | 1 |
| 0.26129 | 1 |
| 0.2613 | 1 |
| 0.26131 | 1 |
| 0.26132 | 1 |
| 0.26133 | 1 |
| 0.26134 | 1 |
| 0.26135 | 1 |
| 0.26136 | 1 |
| 0.26137 | 1 |
| 0.26138 | 1 |
| 0.26139 | 1 |
| 0.2614 | 1 |
| 0.26141 | 1 |
| 0.26142 | 1 |
| 0.26143 | 1 |
| 0.26144 | 1 |
| 0.26145 | 1 |
| 0.26146 | 1 |
| 0.26147 | 1 |
| 0.26148 | 1 |
| 0.26149 | 1 |
| 0.2615 | 1 |
| 0.26151 | 1 |
| 0.26152 | 1 |
| 0.26153 | 1 |
| 0.26154 | 1 |
| 0.26155 | 1 |
| 0.26156 | 1 |
| 0.26157 | 1 |
| 0.26158 | 1 |
| 0.26159 | 1 |
| 0.2616 | 1 |
| 0.26161 | 1 |
| 0.26162 | 1 |
| 0.26163 | 1 |
| 0.26164 | 1 |
| 0.26165 | 1 |
| 0.26166 | 1 |
| 0.26167 | 1 |
| 0.26168 | 1 |
| 0.26169 | 1 |
| 0.2617 | 1 |
| 0.26171 | 1 |
| 0.26172 | 1 |
| 0.26173 | 1 |
| 0.26174 | 1 |
| 0.26175 | 1 |
| 0.26176 | 1 |
| 0.26177 | 1 |
| 0.26178 | 1 |
| 0.26179 | 1 |
| 0.2618 | 1 |
| 0.26181 | 1 |
| 0.26182 | 1 |
| 0.26183 | 1 |
| 0.26184 | 1 |
| 0.26185 | 1 |
| 0.26186 | 1 |
| 0.26187 | 1 |
| 0.26188 | 1 |
| 0.26189 | 1 |
| 0.2619 | 1 |
| 0.26191 | 1 |
| 0.26192 | 1 |
| 0.26193 | 1 |
| 0.26194 | 1 |
| 0.26195 | 1 |
| 0.26196 | 1 |
| 0.26197 | 1 |
| 0.26198 | 1 |
| 0.26199 | 1 |
| 0.262 | 1 |
| 0.26201 | 1 |
| 0.26202 | 1 |
| 0.26203 | 1 |
| 0.26204 | 1 |
| 0.26205 | 1 |
| 0.26206 | 1 |
| 0.26207 | 1 |
| 0.26208 | 1 |
| 0.26209 | 1 |
| 0.2621 | 1 |
| 0.26211 | 1 |
| 0.26212 | 1 |
| 0.26213 | 1 |
| 0.26214 | 1 |
| 0.26215 | 1 |
| 0.26216 | 1 |
| 0.26217 | 1 |
| 0.26218 | 1 |
| 0.26219 | 1 |
| 0.2622 | 1 |
| 0.26221 | 1 |
| 0.26222 | 1 |
| 0.26223 | 1 |
| 0.26224 | 1 |
| 0.26225 | 1 |
| 0.26226 | 1 |
| 0.26227 | 1 |
| 0.26228 | 1 |
| 0.26229 | 1 |
| 0.2623 | 1 |
| 0.26231 | 1 |
| 0.26232 | 1 |
| 0.26233 | 1 |
| 0.26234 | 1 |
| 0.26235 | 1 |
| 0.26236 | 1 |
| 0.26237 | 1 |
| 0.26238 | 1 |
| 0.26239 | 1 |
| 0.2624 | 1 |
| 0.26241 | 1 |
| 0.26242 | 1 |
| 0.26243 | 1 |
| 0.26244 | 1 |
| 0.26245 | 1 |
| 0.26246 | 1 |
| 0.26247 | 1 |
| 0.26248 | 1 |
| 0.26249 | 1 |
| 0.2625 | 1 |
| 0.26251 | 1 |
| 0.26252 | 1 |
| 0.26253 | 1 |
| 0.26254 | 1 |
| 0.26255 | 1 |
| 0.26256 | 1 |
| 0.26257 | 1 |
| 0.26258 | 1 |
| 0.26259 | 1 |
| 0.2626 | 1 |
| 0.26261 | 1 |
| 0.26262 | 1 |
| 0.26263 | 1 |
| 0.26264 | 1 |
| 0.26265 | 1 |
| 0.26266 | 1 |
| 0.26267 | 1 |
| 0.26268 | 1 |
| 0.26269 | 1 |
| 0.2627 | 1 |
| 0.26271 | 1 |
| 0.26272 | 1 |
| 0.26273 | 1 |
| 0.26274 | 1 |
| 0.26275 | 1 |
| 0.26276 | 1 |
| 0.26277 | 1 |
| 0.26278 | 1 |
| 0.26279 | 1 |
| 0.2628 | 1 |
| 0.26281 | 1 |
| 0.26282 | 1 |
| 0.26283 | 1 |
| 0.26284 | 1 |
| 0.26285 | 1 |
| 0.26286 | 1 |
| 0.26287 | 1 |
| 0.26288 | 1 |
| 0.26289 | 1 |
| 0.2629 | 1 |
| 0.26291 | 1 |
| 0.26292 | 1 |
| 0.26293 | 1 |
| 0.26294 | 1 |
| 0.26295 | 1 |
| 0.26296 | 1 |
| 0.26297 | 1 |
| 0.26298 | 1 |
| 0.26299 | 1 |
| 0.263 | 1 |
| 0.26301 | 1 |
| 0.26302 | 1 |
| 0.26303 | 1 |
| 0.26304 | 1 |
| 0.26305 | 1 |
| 0.26306 | 1 |
| 0.26307 | 1 |
| 0.26308 | 1 |
| 0.26309 | 1 |
| 0.2631 | 1 |
| 0.26311 | 1 |
| 0.26312 | 1 |
| 0.26313 | 1 |
| 0.26314 | 1 |
| 0.26315 | 1 |
| 0.26316 | 1 |
| 0.26317 | 1 |
| 0.26318 | 1 |
| 0.26319 | 1 |
| 0.2632 | 1 |
| 0.26321 | 1 |
| 0.26322 | 1 |
| 0.26323 | 1 |
| 0.26324 | 1 |
| 0.26325 | 1 |
| 0.26326 | 1 |
| 0.26327 | 1 |
| 0.26328 | 1 |
| 0.26329 | 1 |
| 0.2633 | 1 |
| 0.26331 | 1 |
| 0.26332 | 1 |
| 0.26333 | 1 |
| 0.26334 | 1 |
| 0.26335 | 1 |
| 0.26336 | 1 |
| 0.26337 | 1 |
| 0.26338 | 1 |
| 0.26339 | 1 |
| 0.2634 | 1 |
| 0.26341 | 1 |
| 0.26342 | 1 |
| 0.26343 | 1 |
| 0.26344 | 1 |
| 0.26345 | 1 |
| 0.26346 | 1 |
| 0.26347 | 1 |
| 0.26348 | 1 |
| 0.26349 | 1 |
| 0.2635 | 1 |
| 0.26351 | 1 |
| 0.26352 | 1 |
| 0.26353 | 1 |
| 0.26354 | 1 |
| 0.26355 | 1 |
| 0.26356 | 1 |
| 0.26357 | 1 |
| 0.26358 | 1 |
| 0.26359 | 1 |
| 0.2636 | 1 |
| 0.26361 | 1 |
| 0.26362 | 1 |
| 0.26363 | 1 |
| 0.26364 | 1 |
| 0.26365 | 1 |
| 0.26366 | 1 |
| 0.26367 | 1 |
| 0.26368 | 1 |
| 0.26369 | 1 |
| 0.2637 | 1 |
| 0.26371 | 1 |
| 0.26372 | 1 |
| 0.26373 | 1 |
| 0.26374 | 1 |
| 0.26375 | 1 |
| 0.26376 | 1 |
| 0.26377 | 1 |
| 0.26378 | 1 |
| 0.26379 | 1 |
| 0.2638 | 1 |
| 0.26381 | 1 |
| 0.26382 | 1 |
| 0.26383 | 1 |
| 0.26384 | 1 |
| 0.26385 | 1 |
| 0.26386 | 1 |
| 0.26387 | 1 |
| 0.26388 | 1 |
| 0.26389 | 1 |
| 0.2639 | 1 |
| 0.26391 | 1 |
| 0.26392 | 1 |
| 0.26393 | 1 |
| 0.26394 | 1 |
| 0.26395 | 1 |
| 0.26396 | 1 |
| 0.26397 | 1 |
| 0.26398 | 1 |
| 0.26399 | 1 |
| 0.264 | 1 |
| 0.26401 | 1 |
| 0.26402 | 1 |
| 0.26403 | 1 |
| 0.26404 | 1 |
| 0.26405 | 1 |
| 0.26406 | 1 |
| 0.26407 | 1 |
| 0.26408 | 1 |
| 0.26409 | 1 |
| 0.2641 | 1 |
| 0.26411 | 1 |
| 0.26412 | 1 |
| 0.26413 | 1 |
| 0.26414 | 1 |
| 0.26415 | 1 |
| 0.26416 | 1 |
| 0.26417 | 1 |
| 0.26418 | 1 |
| 0.26419 | 1 |
| 0.2642 | 1 |
| 0.26421 | 1 |
| 0.26422 | 1 |
| 0.26423 | 1 |
| 0.26424 | 1 |
| 0.26425 | 1 |
| 0.26426 | 1 |
| 0.26427 | 1 |
| 0.26428 | 1 |
| 0.26429 | 1 |
| 0.2643 | 1 |
| 0.26431 | 1 |
| 0.26432 | 1 |
| 0.26433 | 1 |
| 0.26434 | 1 |
| 0.26435 | 1 |
| 0.26436 | 1 |
| 0.26437 | 1 |
| 0.26438 | 1 |
| 0.26439 | 1 |
| 0.2644 | 1 |
| 0.26441 | 1 |
| 0.26442 | 1 |
| 0.26443 | 1 |
| 0.26444 | 1 |
| 0.26445 | 1 |
| 0.26446 | 1 |
| 0.26447 | 1 |
| 0.26448 | 1 |
| 0.26449 | 1 |
| 0.2645 | 1 |
| 0.26451 | 1 |
| 0.26452 | 1 |
| 0.26453 | 1 |
| 0.26454 | 1 |
| 0.26455 | 1 |
| 0.26456 | 1 |
| 0.26457 | 1 |
| 0.26458 | 1 |
| 0.26459 | 1 |
| 0.2646 | 1 |
| 0.26461 | 1 |
| 0.26462 | 1 |
| 0.26463 | 1 |
| 0.26464 | 1 |
| 0.26465 | 1 |
| 0.26466 | 1 |
| 0.26467 | 1 |
| 0.26468 | 1 |
| 0.26469 | 1 |
| 0.2647 | 1 |
| 0.26471 | 1 |
| 0.26472 | 1 |
| 0.26473 | 1 |
| 0.26474 | 1 |
| 0.26475 | 1 |
| 0.26476 | 1 |
| 0.26477 | 1 |
| 0.26478 | 1 |
| 0.26479 | 1 |
| 0.2648 | 1 |
| 0.26481 | 1 |
| 0.26482 | 1 |
| 0.26483 | 1 |
| 0.26484 | 1 |
| 0.26485 | 1 |
| 0.26486 | 1 |
| 0.26487 | 1 |
| 0.26488 | 1 |
| 0.26489 | 1 |
| 0.2649 | 1 |
| 0.26491 | 1 |
| 0.26492 | 1 |
| 0.26493 | 1 |
| 0.26494 | 1 |
| 0.26495 | 1 |
| 0.26496 | 1 |
| 0.26497 | 1 |
| 0.26498 | 1 |
| 0.26499 | 1 |
| 0.265 | 1 |
| 0.26501 | 1 |
| 0.26502 | 1 |
| 0.26503 | 1 |
| 0.26504 | 1 |
| 0.26505 | 1 |
| 0.26506 | 1 |
| 0.26507 | 1 |
| 0.26508 | 1 |
| 0.26509 | 1 |
| 0.2651 | 1 |
| 0.26511 | 1 |
| 0.26512 | 1 |
| 0.26513 | 1 |
| 0.26514 | 1 |
| 0.26515 | 1 |
| 0.26516 | 1 |
| 0.26517 | 1 |
| 0.26518 | 1 |
| 0.26519 | 1 |
| 0.2652 | 1 |
| 0.26521 | 1 |
| 0.26522 | 1 |
| 0.26523 | 1 |
| 0.26524 | 1 |
| 0.26525 | 1 |
| 0.26526 | 1 |
| 0.26527 | 1 |
| 0.26528 | 1 |
| 0.26529 | 1 |
| 0.2653 | 1 |
| 0.26531 | 1 |
| 0.26532 | 1 |
| 0.26533 | 1 |
| 0.26534 | 1 |
| 0.26535 | 1 |
| 0.26536 | 1 |
| 0.26537 | 1 |
| 0.26538 | 1 |
| 0.26539 | 1 |
| 0.2654 | 1 |
| 0.26541 | 1 |
| 0.26542 | 1 |
| 0.26543 | 1 |
| 0.26544 | 1 |
| 0.26545 | 1 |
| 0.26546 | 1 |
| 0.26547 | 1 |
| 0.26548 | 1 |
| 0.26549 | 1 |
| 0.2655 | 1 |
| 0.26551 | 1 |
| 0.26552 | 1 |
| 0.26553 | 1 |
| 0.26554 | 1 |
| 0.26555 | 1 |
| 0.26556 | 1 |
| 0.26557 | 1 |
| 0.26558 | 1 |
| 0.26559 | 1 |
| 0.2656 | 1 |
| 0.26561 | 1 |
| 0.26562 | 1 |
| 0.26563 | 1 |
| 0.26564 | 1 |
| 0.26565 | 1 |
| 0.26566 | 1 |
| 0.26567 | 1 |
| 0.26568 | 1 |
| 0.26569 | 1 |
| 0.2657 | 1 |
| 0.26571 | 1 |
| 0.26572 | 1 |
| 0.26573 | 1 |
| 0.26574 | 1 |
| 0.26575 | 1 |
| 0.26576 | 1 |
| 0.26577 | 1 |
| 0.26578 | 1 |
| 0.26579 | 1 |
| 0.2658 | 1 |
| 0.26581 | 1 |
| 0.26582 | 1 |
| 0.26583 | 1 |
| 0.26584 | 1 |
| 0.26585 | 1 |
| 0.26586 | 1 |
| 0.26587 | 1 |
| 0.26588 | 1 |
| 0.26589 | 1 |
| 0.2659 | 1 |
| 0.26591 | 1 |
| 0.26592 | 1 |
| 0.26593 | 1 |
| 0.26594 | 1 |
| 0.26595 | 1 |
| 0.26596 | 1 |
| 0.26597 | 1 |
| 0.26598 | 1 |
| 0.26599 | 1 |
| 0.266 | 1 |
| 0.26601 | 1 |
| 0.26602 | 1 |
| 0.26603 | 1 |
| 0.26604 | 1 |
| 0.26605 | 1 |
| 0.26606 | 1 |
| 0.26607 | 1 |
| 0.26608 | 1 |
| 0.26609 | 1 |
| 0.2661 | 1 |
| 0.26611 | 1 |
| 0.26612 | 1 |
| 0.26613 | 1 |
| 0.26614 | 1 |
| 0.26615 | 1 |
| 0.26616 | 1 |
| 0.26617 | 1 |
| 0.26618 | 1 |
| 0.26619 | 1 |
| 0.2662 | 1 |
| 0.26621 | 1 |
| 0.26622 | 1 |
| 0.26623 | 1 |
| 0.26624 | 1 |
| 0.26625 | 1 |
| 0.26626 | 1 |
| 0.26627 | 1 |
| 0.26628 | 0.999 |
| 0.26629 | 0.999 |
| 0.2663 | 0.999 |
| 0.26631 | 0.999 |
| 0.26632 | 0.999 |
| 0.26633 | 0.999 |
| 0.26634 | 0.999 |
| 0.26635 | 0.999 |
| 0.26636 | 0.999 |
| 0.26637 | 0.999 |
| 0.26638 | 0.999 |
| 0.26639 | 0.999 |
| 0.2664 | 0.999 |
| 0.26641 | 0.999 |
| 0.26642 | 0.999 |
| 0.26643 | 0.999 |
| 0.26644 | 0.999 |
| 0.26645 | 0.999 |
| 0.26646 | 0.999 |
| 0.26647 | 0.999 |
| 0.26648 | 0.999 |
| 0.26649 | 0.999 |
| 0.2665 | 0.999 |
| 0.26651 | 0.999 |
| 0.26652 | 0.999 |
| 0.26653 | 0.999 |
| 0.26654 | 0.999 |
| 0.26655 | 0.999 |
| 0.26656 | 0.999 |
| 0.26657 | 0.999 |
| 0.26658 | 0.999 |
| 0.26659 | 0.999 |
| 0.2666 | 0.999 |
| 0.26661 | 0.999 |
| 0.26662 | 0.999 |
| 0.26663 | 0.999 |
| 0.26664 | 0.999 |
| 0.26665 | 0.999 |
| 0.26666 | 0.999 |
| 0.26667 | 0.999 |
| 0.26668 | 0.999 |
| 0.26669 | 0.999 |
| 0.2667 | 0.999 |
| 0.26671 | 0.999 |
| 0.26672 | 0.999 |
| 0.26673 | 0.999 |
| 0.26674 | 0.999 |
| 0.26675 | 0.999 |
| 0.26676 | 0.999 |
| 0.26677 | 0.999 |
| 0.26678 | 0.999 |
| 0.26679 | 0.999 |
| 0.2668 | 0.999 |
| 0.26681 | 0.999 |
| 0.26682 | 0.999 |
| 0.26683 | 0.999 |
| 0.26684 | 0.999 |
| 0.26685 | 0.999 |
| 0.26686 | 0.999 |
| 0.26687 | 0.999 |
| 0.26688 | 0.999 |
| 0.26689 | 0.999 |
| 0.2669 | 0.999 |
| 0.26691 | 0.999 |
| 0.26692 | 0.999 |
| 0.26693 | 0.999 |
| 0.26694 | 0.999 |
| 0.26695 | 0.999 |
| 0.26696 | 0.999 |
| 0.26697 | 0.999 |
| 0.26698 | 0.999 |
| 0.26699 | 0.999 |
| 0.267 | 0.999 |
| 0.26701 | 0.999 |
| 0.26702 | 0.999 |
| 0.26703 | 0.999 |
| 0.26704 | 0.999 |
| 0.26705 | 0.999 |
| 0.26706 | 0.999 |
| 0.26707 | 0.999 |
| 0.26708 | 0.999 |
| 0.26709 | 0.999 |
| 0.2671 | 0.999 |
| 0.26711 | 0.999 |
| 0.26712 | 0.999 |
| 0.26713 | 0.999 |
| 0.26714 | 0.999 |
| 0.26715 | 0.999 |
| 0.26716 | 0.999 |
| 0.26717 | 0.999 |
| 0.26718 | 0.999 |
| 0.26719 | 0.999 |
| 0.2672 | 0.999 |
| 0.26721 | 0.999 |
| 0.26722 | 0.999 |
| 0.26723 | 0.999 |
| 0.26724 | 0.999 |
| 0.26725 | 0.999 |
| 0.26726 | 0.999 |
| 0.26727 | 0.999 |
| 0.26728 | 0.999 |
| 0.26729 | 0.999 |
| 0.2673 | 0.999 |
| 0.26731 | 0.999 |
| 0.26732 | 0.999 |
| 0.26733 | 0.999 |
| 0.26734 | 0.999 |
| 0.26735 | 0.999 |
| 0.26736 | 0.999 |
| 0.26737 | 0.999 |
| 0.26738 | 0.999 |
| 0.26739 | 0.999 |
| 0.2674 | 0.999 |
| 0.26741 | 0.999 |
| 0.26742 | 0.999 |
| 0.26743 | 0.999 |
| 0.26744 | 0.999 |
| 0.26745 | 0.999 |
| 0.26746 | 0.999 |
| 0.26747 | 0.999 |
| 0.26748 | 0.999 |
| 0.26749 | 0.999 |
| 0.2675 | 0.999 |
| 0.26751 | 0.999 |
| 0.26752 | 0.999 |
| 0.26753 | 0.999 |
| 0.26754 | 0.999 |
| 0.26755 | 0.999 |
| 0.26756 | 0.999 |
| 0.26757 | 0.999 |
| 0.26758 | 0.999 |
| 0.26759 | 0.999 |
| 0.2676 | 0.999 |
| 0.26761 | 0.999 |
| 0.26762 | 0.999 |
| 0.26763 | 0.999 |
| 0.26764 | 0.999 |
| 0.26765 | 0.999 |
| 0.26766 | 0.999 |
| 0.26767 | 0.999 |
| 0.26768 | 0.999 |
| 0.26769 | 0.999 |
| 0.2677 | 0.999 |
| 0.26771 | 0.999 |
| 0.26772 | 0.999 |
| 0.26773 | 0.999 |
| 0.26774 | 0.999 |
| 0.26775 | 0.999 |
| 0.26776 | 0.999 |
| 0.26777 | 0.999 |
| 0.26778 | 0.999 |
| 0.26779 | 0.999 |
| 0.2678 | 0.999 |
| 0.26781 | 0.999 |
| 0.26782 | 0.999 |
| 0.26783 | 0.999 |
| 0.26784 | 0.999 |
| 0.26785 | 0.999 |
| 0.26786 | 0.999 |
| 0.26787 | 0.999 |
| 0.26788 | 0.999 |
| 0.26789 | 0.999 |
| 0.2679 | 0.999 |
| 0.26791 | 0.999 |
| 0.26792 | 0.999 |
| 0.26793 | 0.999 |
| 0.26794 | 0.999 |
| 0.26795 | 0.999 |
| 0.26796 | 0.999 |
| 0.26797 | 0.999 |
| 0.26798 | 0.999 |
| 0.26799 | 0.999 |
| 0.268 | 0.999 |
| 0.26801 | 0.999 |
| 0.26802 | 0.999 |
| 0.26803 | 0.999 |
| 0.26804 | 0.999 |
| 0.26805 | 0.999 |
| 0.26806 | 0.999 |
| 0.26807 | 0.999 |
| 0.26808 | 0.999 |
| 0.26809 | 0.999 |
| 0.2681 | 0.999 |
| 0.26811 | 0.999 |
| 0.26812 | 0.999 |
| 0.26813 | 0.999 |
| 0.26814 | 0.999 |
| 0.26815 | 0.999 |
| 0.26816 | 0.999 |
| 0.26817 | 0.999 |
| 0.26818 | 0.999 |
| 0.26819 | 0.999 |
| 0.2682 | 0.999 |
| 0.26821 | 0.999 |
| 0.26822 | 0.999 |
| 0.26823 | 0.999 |
| 0.26824 | 0.999 |
| 0.26825 | 0.999 |
| 0.26826 | 0.999 |
| 0.26827 | 0.999 |
| 0.26828 | 0.999 |
| 0.26829 | 0.999 |
| 0.2683 | 0.999 |
| 0.26831 | 0.999 |
| 0.26832 | 0.999 |
| 0.26833 | 0.999 |
| 0.26834 | 0.999 |
| 0.26835 | 0.999 |
| 0.26836 | 0.999 |
| 0.26837 | 0.999 |
| 0.26838 | 0.999 |
| 0.26839 | 0.999 |
| 0.2684 | 0.999 |
| 0.26841 | 0.999 |
| 0.26842 | 0.999 |
| 0.26843 | 0.999 |
| 0.26844 | 0.999 |
| 0.26845 | 0.999 |
| 0.26846 | 0.999 |
| 0.26847 | 0.999 |
| 0.26848 | 0.999 |
| 0.26849 | 0.999 |
| 0.2685 | 0.999 |
| 0.26851 | 0.999 |
| 0.26852 | 0.999 |
| 0.26853 | 0.999 |
| 0.26854 | 0.999 |
| 0.26855 | 0.999 |
| 0.26856 | 0.999 |
| 0.26857 | 0.999 |
| 0.26858 | 0.999 |
| 0.26859 | 0.999 |
| 0.2686 | 0.999 |
| 0.26861 | 0.999 |
| 0.26862 | 0.999 |
| 0.26863 | 0.999 |
| 0.26864 | 0.999 |
| 0.26865 | 0.999 |
| 0.26866 | 0.999 |
| 0.26867 | 0.999 |
| 0.26868 | 0.999 |
| 0.26869 | 0.999 |
| 0.2687 | 0.999 |
| 0.26871 | 0.999 |
| 0.26872 | 0.999 |
| 0.26873 | 0.999 |
| 0.26874 | 0.999 |
| 0.26875 | 0.999 |
| 0.26876 | 0.999 |
| 0.26877 | 0.999 |
| 0.26878 | 0.999 |
| 0.26879 | 0.999 |
| 0.2688 | 0.999 |
| 0.26881 | 0.999 |
| 0.26882 | 0.999 |
| 0.26883 | 0.999 |
| 0.26884 | 0.999 |
| 0.26885 | 0.999 |
| 0.26886 | 0.999 |
| 0.26887 | 0.999 |
| 0.26888 | 0.999 |
| 0.26889 | 0.999 |
| 0.2689 | 0.999 |
| 0.26891 | 0.999 |
| 0.26892 | 0.999 |
| 0.26893 | 0.999 |
| 0.26894 | 0.999 |
| 0.26895 | 0.999 |
| 0.26896 | 0.999 |
| 0.26897 | 0.999 |
| 0.26898 | 0.999 |
| 0.26899 | 0.999 |
| 0.269 | 0.999 |
| 0.26901 | 0.999 |
| 0.26902 | 0.999 |
| 0.26903 | 0.999 |
| 0.26904 | 0.999 |
| 0.26905 | 0.999 |
| 0.26906 | 0.999 |
| 0.26907 | 0.999 |
| 0.26908 | 0.999 |
| 0.26909 | 0.999 |
| 0.2691 | 0.999 |
| 0.26911 | 0.999 |
| 0.26912 | 0.999 |
| 0.26913 | 0.999 |
| 0.26914 | 0.999 |
| 0.26915 | 0.999 |
| 0.26916 | 0.999 |
| 0.26917 | 0.999 |
| 0.26918 | 0.999 |
| 0.26919 | 0.999 |
| 0.2692 | 0.999 |
| 0.26921 | 0.999 |
| 0.26922 | 0.999 |
| 0.26923 | 0.999 |
| 0.26924 | 0.999 |
| 0.26925 | 0.999 |
| 0.26926 | 0.999 |
| 0.26927 | 0.999 |
| 0.26928 | 0.999 |
| 0.26929 | 0.999 |
| 0.2693 | 0.999 |
| 0.26931 | 0.999 |
| 0.26932 | 0.999 |
| 0.26933 | 0.999 |
| 0.26934 | 0.999 |
| 0.26935 | 0.999 |
| 0.26936 | 0.999 |
| 0.26937 | 0.999 |
| 0.26938 | 0.999 |
| 0.26939 | 0.999 |
| 0.2694 | 0.999 |
| 0.26941 | 0.999 |
| 0.26942 | 0.999 |
| 0.26943 | 0.999 |
| 0.26944 | 0.999 |
| 0.26945 | 0.999 |
| 0.26946 | 0.999 |
| 0.26947 | 0.999 |
| 0.26948 | 0.999 |
| 0.26949 | 0.999 |
| 0.2695 | 0.999 |
| 0.26951 | 0.999 |
| 0.26952 | 0.999 |
| 0.26953 | 0.999 |
| 0.26954 | 0.999 |
| 0.26955 | 0.999 |
| 0.26956 | 0.999 |
| 0.26957 | 0.999 |
| 0.26958 | 0.999 |
| 0.26959 | 0.999 |
| 0.2696 | 0.999 |
| 0.26961 | 0.999 |
| 0.26962 | 0.999 |
| 0.26963 | 0.999 |
| 0.26964 | 0.999 |
| 0.26965 | 0.999 |
| 0.26966 | 0.999 |
| 0.26967 | 0.999 |
| 0.26968 | 0.999 |
| 0.26969 | 0.999 |
| 0.2697 | 0.999 |
| 0.26971 | 0.999 |
| 0.26972 | 0.999 |
| 0.26973 | 0.999 |
| 0.26974 | 0.999 |
| 0.26975 | 0.999 |
| 0.26976 | 0.999 |
| 0.26977 | 0.999 |
| 0.26978 | 0.999 |
| 0.26979 | 0.999 |
| 0.2698 | 0.999 |
| 0.26981 | 0.999 |
| 0.26982 | 0.999 |
| 0.26983 | 0.999 |
| 0.26984 | 0.999 |
| 0.26985 | 0.999 |
| 0.26986 | 0.999 |
| 0.26987 | 0.999 |
| 0.26988 | 0.999 |
| 0.26989 | 0.999 |
| 0.2699 | 0.999 |
| 0.26991 | 0.999 |
| 0.26992 | 0.999 |
| 0.26993 | 0.999 |
| 0.26994 | 0.999 |
| 0.26995 | 0.999 |
| 0.26996 | 0.999 |
| 0.26997 | 0.999 |
| 0.26998 | 0.999 |
| 0.26999 | 0.999 |
| 0.27 | 0.999 |
| 0.27001 | 0.999 |
| 0.27002 | 0.999 |
| 0.27003 | 0.999 |
| 0.27004 | 0.999 |
| 0.27005 | 0.999 |
| 0.27006 | 0.999 |
| 0.27007 | 0.999 |
| 0.27008 | 0.999 |
| 0.27009 | 0.999 |
| 0.2701 | 0.999 |
| 0.27011 | 0.999 |
| 0.27012 | 0.999 |
| 0.27013 | 0.999 |
| 0.27014 | 0.999 |
| 0.27015 | 0.999 |
| 0.27016 | 0.999 |
| 0.27017 | 0.999 |
| 0.27018 | 0.999 |
| 0.27019 | 0.999 |
| 0.2702 | 0.999 |
| 0.27021 | 0.999 |
| 0.27022 | 0.999 |
| 0.27023 | 0.999 |
| 0.27024 | 0.999 |
| 0.27025 | 0.999 |
| 0.27026 | 0.999 |
| 0.27027 | 0.999 |
| 0.27028 | 0.999 |
| 0.27029 | 0.999 |
| 0.2703 | 0.999 |
| 0.27031 | 0.999 |
| 0.27032 | 0.999 |
| 0.27033 | 0.999 |
| 0.27034 | 0.999 |
| 0.27035 | 0.999 |
| 0.27036 | 0.999 |
| 0.27037 | 0.999 |
| 0.27038 | 0.999 |
| 0.27039 | 0.999 |
| 0.2704 | 0.999 |
| 0.27041 | 0.999 |
| 0.27042 | 0.999 |
| 0.27043 | 0.999 |
| 0.27044 | 0.999 |
| 0.27045 | 0.999 |
| 0.27046 | 0.999 |
| 0.27047 | 0.999 |
| 0.27048 | 0.999 |
| 0.27049 | 0.999 |
| 0.2705 | 0.999 |
| 0.27051 | 0.999 |
| 0.27052 | 0.999 |
| 0.27053 | 0.999 |
| 0.27054 | 0.999 |
| 0.27055 | 0.999 |
| 0.27056 | 0.999 |
| 0.27057 | 0.999 |
| 0.27058 | 0.999 |
| 0.27059 | 0.999 |
| 0.2706 | 0.999 |
| 0.27061 | 0.999 |
| 0.27062 | 0.999 |
| 0.27063 | 0.999 |
| 0.27064 | 0.999 |
| 0.27065 | 0.999 |
| 0.27066 | 0.999 |
| 0.27067 | 0.999 |
| 0.27068 | 0.999 |
| 0.27069 | 0.999 |
| 0.2707 | 0.999 |
| 0.27071 | 0.999 |
| 0.27072 | 0.999 |
| 0.27073 | 0.999 |
| 0.27074 | 0.999 |
| 0.27075 | 0.999 |
| 0.27076 | 0.999 |
| 0.27077 | 0.999 |
| 0.27078 | 0.999 |
| 0.27079 | 0.999 |
| 0.2708 | 0.999 |
| 0.27081 | 0.999 |
| 0.27082 | 0.999 |
| 0.27083 | 0.999 |
| 0.27084 | 0.999 |
| 0.27085 | 0.999 |
| 0.27086 | 0.999 |
| 0.27087 | 0.999 |
| 0.27088 | 0.999 |
| 0.27089 | 0.999 |
| 0.2709 | 0.999 |
| 0.27091 | 0.999 |
| 0.27092 | 0.999 |
| 0.27093 | 0.999 |
| 0.27094 | 0.999 |
| 0.27095 | 0.999 |
| 0.27096 | 0.999 |
| 0.27097 | 0.999 |
| 0.27098 | 0.999 |
| 0.27099 | 0.999 |
| 0.271 | 0.999 |
| 0.27101 | 0.999 |
| 0.27102 | 0.999 |
| 0.27103 | 0.999 |
| 0.27104 | 0.999 |
| 0.27105 | 0.999 |
| 0.27106 | 0.999 |
| 0.27107 | 0.999 |
| 0.27108 | 0.999 |
| 0.27109 | 0.999 |
| 0.2711 | 0.999 |
| 0.27111 | 0.999 |
| 0.27112 | 0.999 |
| 0.27113 | 0.999 |
| 0.27114 | 0.999 |
| 0.27115 | 0.999 |
| 0.27116 | 0.999 |
| 0.27117 | 0.999 |
| 0.27118 | 0.999 |
| 0.27119 | 0.999 |
| 0.2712 | 0.999 |
| 0.27121 | 0.999 |
| 0.27122 | 0.999 |
| 0.27123 | 0.999 |
| 0.27124 | 0.999 |
| 0.27125 | 0.999 |
| 0.27126 | 0.999 |
| 0.27127 | 0.999 |
| 0.27128 | 0.999 |
| 0.27129 | 0.999 |
| 0.2713 | 0.999 |
| 0.27131 | 0.999 |
| 0.27132 | 0.999 |
| 0.27133 | 0.999 |
| 0.27134 | 0.999 |
| 0.27135 | 0.999 |
| 0.27136 | 0.999 |
| 0.27137 | 0.999 |
| 0.27138 | 0.999 |
| 0.27139 | 0.999 |
| 0.2714 | 0.999 |
| 0.27141 | 0.999 |
| 0.27142 | 0.999 |
| 0.27143 | 0.999 |
| 0.27144 | 0.999 |
| 0.27145 | 0.999 |
| 0.27146 | 0.999 |
| 0.27147 | 0.999 |
| 0.27148 | 0.999 |
| 0.27149 | 0.999 |
| 0.2715 | 0.999 |
| 0.27151 | 0.999 |
| 0.27152 | 0.999 |
| 0.27153 | 0.999 |
| 0.27154 | 0.999 |
| 0.27155 | 0.999 |
| 0.27156 | 0.999 |
| 0.27157 | 0.999 |
| 0.27158 | 0.999 |
| 0.27159 | 0.999 |
| 0.2716 | 0.999 |
| 0.27161 | 0.999 |
| 0.27162 | 0.999 |
| 0.27163 | 0.999 |
| 0.27164 | 0.999 |
| 0.27165 | 0.999 |
| 0.27166 | 0.999 |
| 0.27167 | 0.999 |
| 0.27168 | 0.999 |
| 0.27169 | 0.999 |
| 0.2717 | 0.999 |
| 0.27171 | 0.999 |
| 0.27172 | 0.999 |
| 0.27173 | 0.999 |
| 0.27174 | 0.999 |
| 0.27175 | 0.999 |
| 0.27176 | 0.999 |
| 0.27177 | 0.999 |
| 0.27178 | 0.999 |
| 0.27179 | 0.999 |
| 0.2718 | 0.999 |
| 0.27181 | 0.999 |
| 0.27182 | 0.999 |
| 0.27183 | 0.999 |
| 0.27184 | 0.999 |
| 0.27185 | 0.999 |
| 0.27186 | 0.999 |
| 0.27187 | 0.999 |
| 0.27188 | 0.999 |
| 0.27189 | 0.999 |
| 0.2719 | 0.999 |
| 0.27191 | 0.999 |
| 0.27192 | 0.999 |
| 0.27193 | 0.999 |
| 0.27194 | 0.999 |
| 0.27195 | 0.999 |
| 0.27196 | 0.999 |
| 0.27197 | 0.999 |
| 0.27198 | 0.999 |
| 0.27199 | 0.999 |
| 0.272 | 0.999 |
| 0.27201 | 0.999 |
| 0.27202 | 0.999 |
| 0.27203 | 0.999 |
| 0.27204 | 0.999 |
| 0.27205 | 0.999 |
| 0.27206 | 0.999 |
| 0.27207 | 0.999 |
| 0.27208 | 0.999 |
| 0.27209 | 0.999 |
| 0.2721 | 0.999 |
| 0.27211 | 0.999 |
| 0.27212 | 0.999 |
| 0.27213 | 0.999 |
| 0.27214 | 0.999 |
| 0.27215 | 0.999 |
| 0.27216 | 0.999 |
| 0.27217 | 0.999 |
| 0.27218 | 0.999 |
| 0.27219 | 0.999 |
| 0.2722 | 0.999 |
| 0.27221 | 0.999 |
| 0.27222 | 0.999 |
| 0.27223 | 0.999 |
| 0.27224 | 0.999 |
| 0.27225 | 0.999 |
| 0.27226 | 0.999 |
| 0.27227 | 0.999 |
| 0.27228 | 0.999 |
| 0.27229 | 0.999 |
| 0.2723 | 0.999 |
| 0.27231 | 0.999 |
| 0.27232 | 0.999 |
| 0.27233 | 0.999 |
| 0.27234 | 0.999 |
| 0.27235 | 0.999 |
| 0.27236 | 0.999 |
| 0.27237 | 0.999 |
| 0.27238 | 0.999 |
| 0.27239 | 0.999 |
| 0.2724 | 0.999 |
| 0.27241 | 0.999 |
| 0.27242 | 0.999 |
| 0.27243 | 0.999 |
| 0.27244 | 0.999 |
| 0.27245 | 0.999 |
| 0.27246 | 0.999 |
| 0.27247 | 0.999 |
| 0.27248 | 0.999 |
| 0.27249 | 0.999 |
| 0.2725 | 0.999 |
| 0.27251 | 0.999 |
| 0.27252 | 0.999 |
| 0.27253 | 0.999 |
| 0.27254 | 0.999 |
| 0.27255 | 0.999 |
| 0.27256 | 0.999 |
| 0.27257 | 0.999 |
| 0.27258 | 0.999 |
| 0.27259 | 0.999 |
| 0.2726 | 0.999 |
| 0.27261 | 0.999 |
| 0.27262 | 0.999 |
| 0.27263 | 1 |
| 0.27264 | 1 |
| 0.27265 | 1 |
| 0.27266 | 1 |
| 0.27267 | 1 |
| 0.27268 | 1 |
| 0.27269 | 1 |
| 0.2727 | 1 |
| 0.27271 | 1 |
| 0.27272 | 1 |
| 0.27273 | 1 |
| 0.27274 | 1 |
| 0.27275 | 1 |
| 0.27276 | 1 |
| 0.27277 | 1 |
| 0.27278 | 1 |
| 0.27279 | 1 |
| 0.2728 | 1 |
| 0.27281 | 1 |
| 0.27282 | 1 |
| 0.27283 | 1 |
| 0.27284 | 1 |
| 0.27285 | 1 |
| 0.27286 | 1 |
| 0.27287 | 1 |
| 0.27288 | 1 |
| 0.27289 | 1 |
| 0.2729 | 1 |
| 0.27291 | 1 |
| 0.27292 | 1 |
| 0.27293 | 1 |
| 0.27294 | 1 |
| 0.27295 | 1 |
| 0.27296 | 1 |
| 0.27297 | 1 |
| 0.27298 | 1 |
| 0.27299 | 1 |
| 0.273 | 1 |
| 0.27301 | 1 |
| 0.27302 | 1 |
| 0.27303 | 1 |
| 0.27304 | 1 |
| 0.27305 | 1 |
| 0.27306 | 1 |
| 0.27307 | 1 |
| 0.27308 | 1 |
| 0.27309 | 1 |
| 0.2731 | 1 |
| 0.27311 | 1 |
| 0.27312 | 1 |
| 0.27313 | 1 |
| 0.27314 | 1 |
| 0.27315 | 1 |
| 0.27316 | 1 |
| 0.27317 | 1 |
| 0.27318 | 1 |
| 0.27319 | 1 |
| 0.2732 | 1 |
| 0.27321 | 1 |
| 0.27322 | 1 |
| 0.27323 | 1 |
| 0.27324 | 1 |
| 0.27325 | 1 |
| 0.27326 | 1 |
| 0.27327 | 1 |
| 0.27328 | 1 |
| 0.27329 | 1 |
| 0.2733 | 1 |
| 0.27331 | 1 |
| 0.27332 | 1 |
| 0.27333 | 1 |
| 0.27334 | 1 |
| 0.27335 | 1 |
| 0.27336 | 1 |
| 0.27337 | 1 |
| 0.27338 | 1 |
| 0.27339 | 1 |
| 0.2734 | 1 |
| 0.27341 | 1 |
| 0.27342 | 1 |
| 0.27343 | 1 |
| 0.27344 | 1 |
| 0.27345 | 1 |
| 0.27346 | 1 |
| 0.27347 | 1 |
| 0.27348 | 1 |
| 0.27349 | 1 |
| 0.2735 | 1 |
| 0.27351 | 1 |
| 0.27352 | 1 |
| 0.27353 | 1 |
| 0.27354 | 1 |
| 0.27355 | 1 |
| 0.27356 | 1 |
| 0.27357 | 1 |
| 0.27358 | 1 |
| 0.27359 | 1 |
| 0.2736 | 1 |
| 0.27361 | 1 |
| 0.27362 | 1 |
| 0.27363 | 1 |
| 0.27364 | 1 |
| 0.27365 | 1 |
| 0.27366 | 1 |
| 0.27367 | 1 |
| 0.27368 | 1 |
| 0.27369 | 1 |
| 0.2737 | 1 |
| 0.27371 | 1 |
| 0.27372 | 1 |
| 0.27373 | 1 |
| 0.27374 | 1 |
| 0.27375 | 1 |
| 0.27376 | 1 |
| 0.27377 | 1 |
| 0.27378 | 1 |
| 0.27379 | 1 |
| 0.2738 | 1 |
| 0.27381 | 1 |
| 0.27382 | 1 |
| 0.27383 | 1 |
| 0.27384 | 1 |
| 0.27385 | 1 |
| 0.27386 | 1 |
| 0.27387 | 1 |
| 0.27388 | 1 |
| 0.27389 | 1 |
| 0.2739 | 1 |
| 0.27391 | 1 |
| 0.27392 | 1 |
| 0.27393 | 1 |
| 0.27394 | 1 |
| 0.27395 | 1 |
| 0.27396 | 1 |
| 0.27397 | 1 |
| 0.27398 | 1 |
| 0.27399 | 1 |
| 0.274 | 1 |
| 0.27401 | 1 |
| 0.27402 | 1 |
| 0.27403 | 1 |
| 0.27404 | 1 |
| 0.27405 | 1 |
| 0.27406 | 1 |
| 0.27407 | 1 |
| 0.27408 | 1 |
| 0.27409 | 1 |
| 0.2741 | 1 |
| 0.27411 | 1 |
| 0.27412 | 1 |
| 0.27413 | 1 |
| 0.27414 | 1 |
| 0.27415 | 1 |
| 0.27416 | 1 |
| 0.27417 | 1 |
| 0.27418 | 1 |
| 0.27419 | 1 |
| 0.2742 | 1 |
| 0.27421 | 1 |
| 0.27422 | 1 |
| 0.27423 | 1 |
| 0.27424 | 1 |
| 0.27425 | 1 |
| 0.27426 | 1 |
| 0.27427 | 1 |
| 0.27428 | 1 |
| 0.27429 | 1 |
| 0.2743 | 1 |
| 0.27431 | 1 |
| 0.27432 | 1 |
| 0.27433 | 1 |
| 0.27434 | 1 |
| 0.27435 | 1 |
| 0.27436 | 1 |
| 0.27437 | 1 |
| 0.27438 | 1 |
| 0.27439 | 1 |
| 0.2744 | 1 |
| 0.27441 | 1 |
| 0.27442 | 1 |
| 0.27443 | 1 |
| 0.27444 | 1 |
| 0.27445 | 1 |
| 0.27446 | 1 |
| 0.27447 | 1 |
| 0.27448 | 1 |
| 0.27449 | 1 |
| 0.2745 | 1 |
| 0.27451 | 1 |
| 0.27452 | 1 |
| 0.27453 | 1 |
| 0.27454 | 1 |
| 0.27455 | 1 |
| 0.27456 | 1 |
| 0.27457 | 1 |
| 0.27458 | 1 |
| 0.27459 | 1 |
| 0.2746 | 1 |
| 0.27461 | 1 |
| 0.27462 | 1 |
| 0.27463 | 1 |
| 0.27464 | 1 |
| 0.27465 | 1 |
| 0.27466 | 1 |
| 0.27467 | 1 |
| 0.27468 | 1 |
| 0.27469 | 1 |
| 0.2747 | 1 |
| 0.27471 | 1 |
| 0.27472 | 1 |
| 0.27473 | 1 |
| 0.27474 | 1 |
| 0.27475 | 1 |
| 0.27476 | 1 |
| 0.27477 | 1 |
| 0.27478 | 1 |
| 0.27479 | 1 |
| 0.2748 | 1 |
| 0.27481 | 1 |
| 0.27482 | 1 |
| 0.27483 | 1 |
| 0.27484 | 1 |
| 0.27485 | 1 |
| 0.27486 | 1 |
| 0.27487 | 1 |
| 0.27488 | 1 |
| 0.27489 | 1 |
| 0.2749 | 1 |
| 0.27491 | 1 |
| 0.27492 | 1 |
| 0.27493 | 1 |
| 0.27494 | 1 |
| 0.27495 | 1 |
| 0.27496 | 1 |
| 0.27497 | 1 |
| 0.27498 | 1 |
| 0.27499 | 1 |
| 0.275 | 1 |
| 0.27501 | 1 |
| 0.27502 | 1 |
| 0.27503 | 1 |
| 0.27504 | 1 |
| 0.27505 | 1 |
| 0.27506 | 1 |
| 0.27507 | 1 |
| 0.27508 | 1 |
| 0.27509 | 1 |
| 0.2751 | 1 |
| 0.27511 | 1 |
| 0.27512 | 1 |
| 0.27513 | 1 |
| 0.27514 | 1 |
| 0.27515 | 1 |
| 0.27516 | 1 |
| 0.27517 | 1 |
| 0.27518 | 1 |
| 0.27519 | 1 |
| 0.2752 | 1 |
| 0.27521 | 1 |
| 0.27522 | 1 |
| 0.27523 | 1 |
| 0.27524 | 1 |
| 0.27525 | 1 |
| 0.27526 | 1 |
| 0.27527 | 1 |
| 0.27528 | 1 |
| 0.27529 | 1 |
| 0.2753 | 1 |
| 0.27531 | 1 |
| 0.27532 | 1 |
| 0.27533 | 1 |
| 0.27534 | 1 |
| 0.27535 | 1 |
| 0.27536 | 1 |
| 0.27537 | 1 |
| 0.27538 | 1 |
| 0.27539 | 1 |
| 0.2754 | 1 |
| 0.27541 | 1 |
| 0.27542 | 1 |
| 0.27543 | 1 |
| 0.27544 | 1 |
| 0.27545 | 1 |
| 0.27546 | 1 |
| 0.27547 | 1 |
| 0.27548 | 1 |
| 0.27549 | 1 |
| 0.2755 | 1 |
| 0.27551 | 1 |
| 0.27552 | 1 |
| 0.27553 | 1 |
| 0.27554 | 1 |
| 0.27555 | 1 |
| 0.27556 | 1 |
| 0.27557 | 1 |
| 0.27558 | 1 |
| 0.27559 | 1 |
| 0.2756 | 1 |
| 0.27561 | 1 |
| 0.27562 | 1 |
| 0.27563 | 1 |
| 0.27564 | 1 |
| 0.27565 | 1 |
| 0.27566 | 1 |
| 0.27567 | 1 |
| 0.27568 | 1 |
| 0.27569 | 1 |
| 0.2757 | 1 |
| 0.27571 | 1 |
| 0.27572 | 1 |
| 0.27573 | 1 |
| 0.27574 | 1 |
| 0.27575 | 1 |
| 0.27576 | 1 |
| 0.27577 | 1 |
| 0.27578 | 1 |
| 0.27579 | 1 |
| 0.2758 | 1 |
| 0.27581 | 1 |
| 0.27582 | 1 |
| 0.27583 | 1 |
| 0.27584 | 1 |
| 0.27585 | 1 |
| 0.27586 | 1 |
| 0.27587 | 1 |
| 0.27588 | 1 |
| 0.27589 | 1 |
| 0.2759 | 1 |
| 0.27591 | 1 |
| 0.27592 | 1 |
| 0.27593 | 1 |
| 0.27594 | 1 |
| 0.27595 | 1 |
| 0.27596 | 1 |
| 0.27597 | 1 |
| 0.27598 | 1 |
| 0.27599 | 1 |
| 0.276 | 1 |
| 0.27601 | 1 |
| 0.27602 | 1 |
| 0.27603 | 1 |
| 0.27604 | 1 |
| 0.27605 | 1 |
| 0.27606 | 1 |
| 0.27607 | 1 |
| 0.27608 | 1 |
| 0.27609 | 1 |
| 0.2761 | 1 |
| 0.27611 | 1 |
| 0.27612 | 1 |
| 0.27613 | 1 |
| 0.27614 | 1 |
| 0.27615 | 1 |
| 0.27616 | 1 |
| 0.27617 | 1 |
| 0.27618 | 1 |
| 0.27619 | 1 |
| 0.2762 | 1 |
| 0.27621 | 1 |
| 0.27622 | 1 |
| 0.27623 | 1 |
| 0.27624 | 1 |
| 0.27625 | 1 |
| 0.27626 | 1 |
| 0.27627 | 1 |
| 0.27628 | 1 |
| 0.27629 | 1 |
| 0.2763 | 1 |
| 0.27631 | 1 |
| 0.27632 | 1 |
| 0.27633 | 1 |
| 0.27634 | 1 |
| 0.27635 | 1 |
| 0.27636 | 1 |
| 0.27637 | 1 |
| 0.27638 | 1 |
| 0.27639 | 1 |
| 0.2764 | 1 |
| 0.27641 | 1 |
| 0.27642 | 1 |
| 0.27643 | 1 |
| 0.27644 | 1 |
| 0.27645 | 1 |
| 0.27646 | 1 |
| 0.27647 | 1 |
| 0.27648 | 1 |
| 0.27649 | 1 |
| 0.2765 | 1 |
| 0.27651 | 1 |
| 0.27652 | 1 |
| 0.27653 | 1 |
| 0.27654 | 1 |
| 0.27655 | 1 |
| 0.27656 | 1 |
| 0.27657 | 1 |
| 0.27658 | 1 |
| 0.27659 | 1 |
| 0.2766 | 1 |
| 0.27661 | 1 |
| 0.27662 | 1 |
| 0.27663 | 1 |
| 0.27664 | 1 |
| 0.27665 | 1 |
| 0.27666 | 1 |
| 0.27667 | 1 |
| 0.27668 | 1 |
| 0.27669 | 1 |
| 0.2767 | 1 |
| 0.27671 | 1 |
| 0.27672 | 1 |
| 0.27673 | 1 |
| 0.27674 | 1 |
| 0.27675 | 1 |
| 0.27676 | 1 |
| 0.27677 | 1 |
| 0.27678 | 1 |
| 0.27679 | 1 |
| 0.2768 | 1 |
| 0.27681 | 1 |
| 0.27682 | 1 |
| 0.27683 | 1 |
| 0.27684 | 1 |
| 0.27685 | 1 |
| 0.27686 | 1 |
| 0.27687 | 1 |
| 0.27688 | 1 |
| 0.27689 | 1 |
| 0.2769 | 1 |
| 0.27691 | 1 |
| 0.27692 | 1 |
| 0.27693 | 1 |
| 0.27694 | 1 |
| 0.27695 | 1 |
| 0.27696 | 1 |
| 0.27697 | 1 |
| 0.27698 | 1 |
| 0.27699 | 1 |
| 0.277 | 1 |
| 0.27701 | 1 |
| 0.27702 | 1 |
| 0.27703 | 1 |
| 0.27704 | 1 |
| 0.27705 | 1 |
| 0.27706 | 1 |
| 0.27707 | 1 |
| 0.27708 | 1 |
| 0.27709 | 1 |
| 0.2771 | 1 |
| 0.27711 | 1 |
| 0.27712 | 1 |
| 0.27713 | 1 |
| 0.27714 | 1 |
| 0.27715 | 1 |
| 0.27716 | 1 |
| 0.27717 | 1 |
| 0.27718 | 1 |
| 0.27719 | 1 |
| 0.2772 | 1 |
| 0.27721 | 1 |
| 0.27722 | 1 |
| 0.27723 | 1 |
| 0.27724 | 1 |
| 0.27725 | 1 |
| 0.27726 | 1 |
| 0.27727 | 1 |
| 0.27728 | 1 |
| 0.27729 | 1 |
| 0.2773 | 1 |
| 0.27731 | 1 |
| 0.27732 | 1 |
| 0.27733 | 1 |
| 0.27734 | 1 |
| 0.27735 | 1 |
| 0.27736 | 1 |
| 0.27737 | 1 |
| 0.27738 | 1 |
| 0.27739 | 1 |
| 0.2774 | 1 |
| 0.27741 | 1 |
| 0.27742 | 1 |
| 0.27743 | 1 |
| 0.27744 | 1 |
| 0.27745 | 1 |
| 0.27746 | 1 |
| 0.27747 | 1 |
| 0.27748 | 1 |
| 0.27749 | 1 |
| 0.2775 | 1 |
| 0.27751 | 1 |
| 0.27752 | 1 |
| 0.27753 | 1 |
| 0.27754 | 1 |
| 0.27755 | 1 |
| 0.27756 | 1 |
| 0.27757 | 1 |
| 0.27758 | 1 |
| 0.27759 | 1 |
| 0.2776 | 1 |
| 0.27761 | 1 |
| 0.27762 | 1 |
| 0.27763 | 1 |
| 0.27764 | 1 |
| 0.27765 | 1 |
| 0.27766 | 1 |
| 0.27767 | 1 |
| 0.27768 | 1 |
| 0.27769 | 1 |
| 0.2777 | 1 |
| 0.27771 | 1 |
| 0.27772 | 1 |
| 0.27773 | 1 |
| 0.27774 | 1 |
| 0.27775 | 1 |
| 0.27776 | 1 |
| 0.27777 | 1 |
| 0.27778 | 1 |
| 0.27779 | 1 |
| 0.2778 | 1 |
| 0.27781 | 1 |
| 0.27782 | 1 |
| 0.27783 | 1 |
| 0.27784 | 1 |
| 0.27785 | 1 |
| 0.27786 | 1 |
| 0.27787 | 1 |
| 0.27788 | 1 |
| 0.27789 | 1 |
| 0.2779 | 1 |
| 0.27791 | 1 |
| 0.27792 | 1 |
| 0.27793 | 1 |
| 0.27794 | 1 |
| 0.27795 | 1 |
| 0.27796 | 1 |
| 0.27797 | 1 |
| 0.27798 | 1 |
| 0.27799 | 1 |
| 0.278 | 1 |
| 0.27801 | 1 |
| 0.27802 | 1 |
| 0.27803 | 1 |
| 0.27804 | 1 |
| 0.27805 | 1 |
| 0.27806 | 1 |
| 0.27807 | 1 |
| 0.27808 | 1 |
| 0.27809 | 1 |
| 0.2781 | 1 |
| 0.27811 | 1 |
| 0.27812 | 1 |
| 0.27813 | 1 |
| 0.27814 | 1 |
| 0.27815 | 1 |
| 0.27816 | 1 |
| 0.27817 | 1 |
| 0.27818 | 1 |
| 0.27819 | 1 |
| 0.2782 | 1 |
| 0.27821 | 1 |
| 0.27822 | 1 |
| 0.27823 | 1 |
| 0.27824 | 1 |
| 0.27825 | 1 |
| 0.27826 | 1 |
| 0.27827 | 1 |
| 0.27828 | 1 |
| 0.27829 | 1 |
| 0.2783 | 1 |
| 0.27831 | 1 |
| 0.27832 | 1 |
| 0.27833 | 1 |
| 0.27834 | 1 |
| 0.27835 | 1 |
| 0.27836 | 1 |
| 0.27837 | 1 |
| 0.27838 | 1 |
| 0.27839 | 1 |
| 0.2784 | 1 |
| 0.27841 | 1 |
| 0.27842 | 1 |
| 0.27843 | 1 |
| 0.27844 | 1 |
| 0.27845 | 1 |
| 0.27846 | 1 |
| 0.27847 | 1 |
| 0.27848 | 1 |
| 0.27849 | 1 |
| 0.2785 | 1 |
| 0.27851 | 1 |
| 0.27852 | 1 |
| 0.27853 | 1 |
| 0.27854 | 1 |
| 0.27855 | 1 |
| 0.27856 | 1 |
| 0.27857 | 1 |
| 0.27858 | 1 |
| 0.27859 | 1 |
| 0.2786 | 1 |
| 0.27861 | 1 |
| 0.27862 | 1 |
| 0.27863 | 1 |
| 0.27864 | 1 |
| 0.27865 | 1 |
| 0.27866 | 1 |
| 0.27867 | 1 |
| 0.27868 | 1 |
| 0.27869 | 1 |
| 0.2787 | 1 |
| 0.27871 | 1 |
| 0.27872 | 1 |
| 0.27873 | 1 |
| 0.27874 | 1 |
| 0.27875 | 1 |
| 0.27876 | 1 |
| 0.27877 | 1 |
| 0.27878 | 1 |
| 0.27879 | 1 |
| 0.2788 | 1 |
| 0.27881 | 1 |
| 0.27882 | 1 |
| 0.27883 | 1 |
| 0.27884 | 1 |
| 0.27885 | 1 |
| 0.27886 | 1 |
| 0.27887 | 1 |
| 0.27888 | 1 |
| 0.27889 | 1 |
| 0.2789 | 1 |
| 0.27891 | 1 |
| 0.27892 | 1 |
| 0.27893 | 1 |
| 0.27894 | 1 |
| 0.27895 | 1 |
| 0.27896 | 1 |
| 0.27897 | 1 |
| 0.27898 | 1 |
| 0.27899 | 1 |
| 0.279 | 1 |
| 0.27901 | 1 |
| 0.27902 | 1 |
| 0.27903 | 1 |
| 0.27904 | 1 |
| 0.27905 | 1 |
| 0.27906 | 1 |
| 0.27907 | 1 |
| 0.27908 | 1 |
| 0.27909 | 1 |
| 0.2791 | 1 |
| 0.27911 | 1 |
| 0.27912 | 1 |
| 0.27913 | 1 |
| 0.27914 | 1 |
| 0.27915 | 1 |
| 0.27916 | 1 |
| 0.27917 | 1 |
| 0.27918 | 1 |
| 0.27919 | 1 |
| 0.2792 | 1 |
| 0.27921 | 1 |
| 0.27922 | 1 |
| 0.27923 | 1 |
| 0.27924 | 1 |
| 0.27925 | 1 |
| 0.27926 | 1 |
| 0.27927 | 1 |
| 0.27928 | 1 |
| 0.27929 | 1 |
| 0.2793 | 1 |
| 0.27931 | 1 |
| 0.27932 | 1 |
| 0.27933 | 1 |
| 0.27934 | 1 |
| 0.27935 | 1 |
| 0.27936 | 1 |
| 0.27937 | 1 |
| 0.27938 | 1 |
| 0.27939 | 1 |
| 0.2794 | 1 |
| 0.27941 | 1 |
| 0.27942 | 1 |
| 0.27943 | 1 |
| 0.27944 | 1 |
| 0.27945 | 1 |
| 0.27946 | 1 |
| 0.27947 | 1 |
| 0.27948 | 1 |
| 0.27949 | 1 |
| 0.2795 | 1 |
| 0.27951 | 1 |
| 0.27952 | 1 |
| 0.27953 | 1 |
| 0.27954 | 1 |
| 0.27955 | 1 |
| 0.27956 | 1 |
| 0.27957 | 1 |
| 0.27958 | 1 |
| 0.27959 | 1 |
| 0.2796 | 1 |
| 0.27961 | 1 |
| 0.27962 | 1 |
| 0.27963 | 1 |
| 0.27964 | 1 |
| 0.27965 | 1 |
| 0.27966 | 1 |
| 0.27967 | 1 |
| 0.27968 | 1 |
| 0.27969 | 1 |
| 0.2797 | 1 |
| 0.27971 | 1 |
| 0.27972 | 1 |
| 0.27973 | 1 |
| 0.27974 | 1 |
| 0.27975 | 1 |
| 0.27976 | 1 |
| 0.27977 | 1 |
| 0.27978 | 1 |
| 0.27979 | 1 |
| 0.2798 | 1 |
| 0.27981 | 1 |
| 0.27982 | 1 |
| 0.27983 | 1 |
| 0.27984 | 1 |
| 0.27985 | 1 |
| 0.27986 | 1 |
| 0.27987 | 1 |
| 0.27988 | 1 |
| 0.27989 | 1 |
| 0.2799 | 1 |
| 0.27991 | 1 |
| 0.27992 | 1 |
| 0.27993 | 1 |
| 0.27994 | 1 |
| 0.27995 | 1 |
| 0.27996 | 1 |
| 0.27997 | 1 |
| 0.27998 | 1 |
| 0.27999 | 1 |
| 0.28 | 1 |
| 0.28001 | 1 |
| 0.28002 | 1 |
| 0.28003 | 1 |
| 0.28004 | 1 |
| 0.28005 | 1 |
| 0.28006 | 1 |
| 0.28007 | 1 |
| 0.28008 | 1 |
| 0.28009 | 1 |
| 0.2801 | 1 |
| 0.28011 | 1 |
| 0.28012 | 1 |
| 0.28013 | 1 |
| 0.28014 | 1 |
| 0.28015 | 1 |
| 0.28016 | 1 |
| 0.28017 | 1 |
| 0.28018 | 1 |
| 0.28019 | 1 |
| 0.2802 | 1 |
| 0.28021 | 1 |
| 0.28022 | 1 |
| 0.28023 | 1 |
| 0.28024 | 1 |
| 0.28025 | 1 |
| 0.28026 | 1 |
| 0.28027 | 1 |
| 0.28028 | 1 |
| 0.28029 | 1 |
| 0.2803 | 1 |
| 0.28031 | 1 |
| 0.28032 | 1 |
| 0.28033 | 1 |
| 0.28034 | 1 |
| 0.28035 | 1 |
| 0.28036 | 1 |
| 0.28037 | 1 |
| 0.28038 | 1 |
| 0.28039 | 1 |
| 0.2804 | 1 |
| 0.28041 | 1 |
| 0.28042 | 1 |
| 0.28043 | 1 |
| 0.28044 | 1 |
| 0.28045 | 1 |
| 0.28046 | 1 |
| 0.28047 | 1 |
| 0.28048 | 1 |
| 0.28049 | 1 |
| 0.2805 | 1 |
| 0.28051 | 1 |
| 0.28052 | 1 |
| 0.28053 | 1 |
| 0.28054 | 1 |
| 0.28055 | 1 |
| 0.28056 | 1 |
| 0.28057 | 1 |
| 0.28058 | 1 |
| 0.28059 | 1 |
| 0.2806 | 1 |
| 0.28061 | 1 |
| 0.28062 | 1 |
| 0.28063 | 1 |
| 0.28064 | 1 |
| 0.28065 | 1 |
| 0.28066 | 1 |
| 0.28067 | 1 |
| 0.28068 | 1 |
| 0.28069 | 1 |
| 0.2807 | 1 |
| 0.28071 | 1 |
| 0.28072 | 1 |
| 0.28073 | 1 |
| 0.28074 | 1 |
| 0.28075 | 1 |
| 0.28076 | 1 |
| 0.28077 | 1 |
| 0.28078 | 1 |
| 0.28079 | 1 |
| 0.2808 | 1 |
| 0.28081 | 1 |
| 0.28082 | 1 |
| 0.28083 | 1 |
| 0.28084 | 1 |
| 0.28085 | 1 |
| 0.28086 | 1 |
| 0.28087 | 1 |
| 0.28088 | 1 |
| 0.28089 | 1 |
| 0.2809 | 1 |
| 0.28091 | 1 |
| 0.28092 | 1 |
| 0.28093 | 1 |
| 0.28094 | 1 |
| 0.28095 | 1 |
| 0.28096 | 1 |
| 0.28097 | 1 |
| 0.28098 | 1 |
| 0.28099 | 1 |
| 0.281 | 1 |
| 0.28101 | 1 |
| 0.28102 | 1 |
| 0.28103 | 1 |
| 0.28104 | 1 |
| 0.28105 | 1 |
| 0.28106 | 1 |
| 0.28107 | 1 |
| 0.28108 | 1 |
| 0.28109 | 1 |
| 0.2811 | 1 |
| 0.28111 | 1 |
| 0.28112 | 1 |
| 0.28113 | 1 |
| 0.28114 | 1 |
| 0.28115 | 1 |
| 0.28116 | 1 |
| 0.28117 | 1 |
| 0.28118 | 1 |
| 0.28119 | 1 |
| 0.2812 | 1 |
| 0.28121 | 1 |
| 0.28122 | 1 |
| 0.28123 | 1 |
| 0.28124 | 1 |
| 0.28125 | 1 |
| 0.28126 | 1 |
| 0.28127 | 1 |
| 0.28128 | 1 |
| 0.28129 | 1 |
| 0.2813 | 1 |
| 0.28131 | 1 |
| 0.28132 | 1 |
| 0.28133 | 1 |
| 0.28134 | 1 |
| 0.28135 | 1 |
| 0.28136 | 1 |
| 0.28137 | 1 |
| 0.28138 | 1 |
| 0.28139 | 1 |
| 0.2814 | 1 |
| 0.28141 | 1 |
| 0.28142 | 1 |
| 0.28143 | 1 |
| 0.28144 | 1 |
| 0.28145 | 1 |
| 0.28146 | 1 |
| 0.28147 | 1 |
| 0.28148 | 1 |
| 0.28149 | 1 |
| 0.2815 | 1 |
| 0.28151 | 1 |
| 0.28152 | 1 |
| 0.28153 | 1 |
| 0.28154 | 1 |
| 0.28155 | 1 |
| 0.28156 | 1 |
| 0.28157 | 1 |
| 0.28158 | 1 |
| 0.28159 | 1 |
| 0.2816 | 1 |
| 0.28161 | 1 |
| 0.28162 | 1 |
| 0.28163 | 1 |
| 0.28164 | 1 |
| 0.28165 | 1 |
| 0.28166 | 1 |
| 0.28167 | 1 |
| 0.28168 | 1 |
| 0.28169 | 1 |
| 0.2817 | 1 |
| 0.28171 | 1 |
| 0.28172 | 1 |
| 0.28173 | 1 |
| 0.28174 | 1 |
| 0.28175 | 1 |
| 0.28176 | 1 |
| 0.28177 | 1 |
| 0.28178 | 1 |
| 0.28179 | 1 |
| 0.2818 | 1 |
| 0.28181 | 1 |
| 0.28182 | 1 |
| 0.28183 | 1 |
| 0.28184 | 1 |
| 0.28185 | 1 |
| 0.28186 | 1 |
| 0.28187 | 1 |
| 0.28188 | 1 |
| 0.28189 | 1 |
| 0.2819 | 1 |
| 0.28191 | 1 |
| 0.28192 | 1 |
| 0.28193 | 1 |
| 0.28194 | 1 |
| 0.28195 | 1 |
| 0.28196 | 1 |
| 0.28197 | 1 |
| 0.28198 | 1 |
| 0.28199 | 1 |
| 0.282 | 1 |
| 0.28201 | 1 |
| 0.28202 | 1 |
| 0.28203 | 1 |
| 0.28204 | 1 |
| 0.28205 | 1 |
| 0.28206 | 1 |
| 0.28207 | 1 |
| 0.28208 | 1 |
| 0.28209 | 1 |
| 0.2821 | 1 |
| 0.28211 | 1 |
| 0.28212 | 1 |
| 0.28213 | 1 |
| 0.28214 | 1 |
| 0.28215 | 1 |
| 0.28216 | 1 |
| 0.28217 | 1 |
| 0.28218 | 1 |
| 0.28219 | 1 |
| 0.2822 | 1 |
| 0.28221 | 1 |
| 0.28222 | 1 |
| 0.28223 | 1 |
| 0.28224 | 1 |
| 0.28225 | 1 |
| 0.28226 | 1 |
| 0.28227 | 1 |
| 0.28228 | 1 |
| 0.28229 | 1 |
| 0.2823 | 1 |
| 0.28231 | 1 |
| 0.28232 | 1 |
| 0.28233 | 1 |
| 0.28234 | 1 |
| 0.28235 | 1 |
| 0.28236 | 1 |
| 0.28237 | 1 |
| 0.28238 | 1 |
| 0.28239 | 1 |
| 0.2824 | 1 |
| 0.28241 | 1 |
| 0.28242 | 1 |
| 0.28243 | 1 |
| 0.28244 | 1 |
| 0.28245 | 1 |
| 0.28246 | 1 |
| 0.28247 | 1 |
| 0.28248 | 1 |
| 0.28249 | 1 |
| 0.2825 | 1 |
| 0.28251 | 1 |
| 0.28252 | 1 |
| 0.28253 | 1 |
| 0.28254 | 1 |
| 0.28255 | 1 |
| 0.28256 | 1 |
| 0.28257 | 1 |
| 0.28258 | 1 |
| 0.28259 | 1 |
| 0.2826 | 1 |
| 0.28261 | 1 |
| 0.28262 | 1 |
| 0.28263 | 1 |
| 0.28264 | 1 |
| 0.28265 | 1 |
| 0.28266 | 1 |
| 0.28267 | 1 |
| 0.28268 | 1 |
| 0.28269 | 1 |
| 0.2827 | 1 |
| 0.28271 | 1 |
| 0.28272 | 1 |
| 0.28273 | 1 |
| 0.28274 | 1 |
| 0.28275 | 1 |
| 0.28276 | 1 |
| 0.28277 | 1 |
| 0.28278 | 1 |
| 0.28279 | 1 |
| 0.2828 | 1 |
| 0.28281 | 1 |
| 0.28282 | 1 |
| 0.28283 | 1 |
| 0.28284 | 1 |
| 0.28285 | 1 |
| 0.28286 | 1 |
| 0.28287 | 1 |
| 0.28288 | 1 |
| 0.28289 | 1 |
| 0.2829 | 1 |
| 0.28291 | 1 |
| 0.28292 | 1 |
| 0.28293 | 1 |
| 0.28294 | 1 |
| 0.28295 | 1 |
| 0.28296 | 1 |
| 0.28297 | 1 |
| 0.28298 | 1 |
| 0.28299 | 1 |
| 0.283 | 1 |
| 0.28301 | 1 |
| 0.28302 | 1 |
| 0.28303 | 1 |
| 0.28304 | 1 |
| 0.28305 | 1 |
| 0.28306 | 1 |
| 0.28307 | 1 |
| 0.28308 | 1 |
| 0.28309 | 1 |
| 0.2831 | 1 |
| 0.28311 | 1 |
| 0.28312 | 1 |
| 0.28313 | 1 |
| 0.28314 | 1 |
| 0.28315 | 1 |
| 0.28316 | 1 |
| 0.28317 | 1 |
| 0.28318 | 1 |
| 0.28319 | 1 |
| 0.2832 | 1 |
| 0.28321 | 1 |
| 0.28322 | 1 |
| 0.28323 | 1 |
| 0.28324 | 1 |
| 0.28325 | 1 |
| 0.28326 | 1 |
| 0.28327 | 1 |
| 0.28328 | 1 |
| 0.28329 | 1 |
| 0.2833 | 1 |
| 0.28331 | 1 |
| 0.28332 | 1 |
| 0.28333 | 1 |
| 0.28334 | 1 |
| 0.28335 | 1 |
| 0.28336 | 1 |
| 0.28337 | 1 |
| 0.28338 | 1 |
| 0.28339 | 1 |
| 0.2834 | 1 |
| 0.28341 | 1 |
| 0.28342 | 1 |
| 0.28343 | 1 |
| 0.28344 | 1 |
| 0.28345 | 1 |
| 0.28346 | 1 |
| 0.28347 | 1 |
| 0.28348 | 1 |
| 0.28349 | 1 |
| 0.2835 | 1 |
| 0.28351 | 1 |
| 0.28352 | 1 |
| 0.28353 | 1 |
| 0.28354 | 1 |
| 0.28355 | 1 |
| 0.28356 | 1 |
| 0.28357 | 1 |
| 0.28358 | 1 |
| 0.28359 | 1 |
| 0.2836 | 1 |
| 0.28361 | 1 |
| 0.28362 | 1 |
| 0.28363 | 1 |
| 0.28364 | 1 |
| 0.28365 | 1 |
| 0.28366 | 1 |
| 0.28367 | 1 |
| 0.28368 | 1 |
| 0.28369 | 1 |
| 0.2837 | 1 |
| 0.28371 | 1 |
| 0.28372 | 1 |
| 0.28373 | 1 |
| 0.28374 | 1 |
| 0.28375 | 1 |
| 0.28376 | 1 |
| 0.28377 | 1 |
| 0.28378 | 1 |
| 0.28379 | 1 |
| 0.2838 | 1 |
| 0.28381 | 1 |
| 0.28382 | 1 |
| 0.28383 | 1 |
| 0.28384 | 1 |
| 0.28385 | 1 |
| 0.28386 | 1 |
| 0.28387 | 1 |
| 0.28388 | 1 |
| 0.28389 | 1 |
| 0.2839 | 1 |
| 0.28391 | 1 |
| 0.28392 | 1 |
| 0.28393 | 1 |
| 0.28394 | 1 |
| 0.28395 | 1 |
| 0.28396 | 1 |
| 0.28397 | 1 |
| 0.28398 | 1 |
| 0.28399 | 1 |
| 0.284 | 1 |
| 0.28401 | 1 |
| 0.28402 | 1 |
| 0.28403 | 1 |
| 0.28404 | 1 |
| 0.28405 | 1 |
| 0.28406 | 1 |
| 0.28407 | 1 |
| 0.28408 | 1 |
| 0.28409 | 1 |
| 0.2841 | 1 |
| 0.28411 | 1 |
| 0.28412 | 1 |
| 0.28413 | 1 |
| 0.28414 | 1 |
| 0.28415 | 1 |
| 0.28416 | 1 |
| 0.28417 | 1 |
| 0.28418 | 1 |
| 0.28419 | 1 |
| 0.2842 | 1 |
| 0.28421 | 1 |
| 0.28422 | 1 |
| 0.28423 | 1 |
| 0.28424 | 1 |
| 0.28425 | 1 |
| 0.28426 | 1 |
| 0.28427 | 1 |
| 0.28428 | 1 |
| 0.28429 | 1 |
| 0.2843 | 1 |
| 0.28431 | 1 |
| 0.28432 | 1 |
| 0.28433 | 1 |
| 0.28434 | 1 |
| 0.28435 | 1 |
| 0.28436 | 1 |
| 0.28437 | 1 |
| 0.28438 | 1 |
| 0.28439 | 1 |
| 0.2844 | 1 |
| 0.28441 | 1 |
| 0.28442 | 1 |
| 0.28443 | 1 |
| 0.28444 | 1 |
| 0.28445 | 1 |
| 0.28446 | 1 |
| 0.28447 | 1 |
| 0.28448 | 1 |
| 0.28449 | 1 |
| 0.2845 | 1 |
| 0.28451 | 1 |
| 0.28452 | 1 |
| 0.28453 | 1 |
| 0.28454 | 1 |
| 0.28455 | 1 |
| 0.28456 | 1 |
| 0.28457 | 1 |
| 0.28458 | 1 |
| 0.28459 | 1 |
| 0.2846 | 1 |
| 0.28461 | 1 |
| 0.28462 | 1 |
| 0.28463 | 1 |
| 0.28464 | 1 |
| 0.28465 | 1 |
| 0.28466 | 1 |
| 0.28467 | 1 |
| 0.28468 | 1 |
| 0.28469 | 1 |
| 0.2847 | 1 |
| 0.28471 | 1 |
| 0.28472 | 1 |
| 0.28473 | 1 |
| 0.28474 | 1 |
| 0.28475 | 1 |
| 0.28476 | 1 |
| 0.28477 | 1 |
| 0.28478 | 1 |
| 0.28479 | 1 |
| 0.2848 | 1 |
| 0.28481 | 1 |
| 0.28482 | 1 |
| 0.28483 | 1 |
| 0.28484 | 1 |
| 0.28485 | 1 |
| 0.28486 | 1 |
| 0.28487 | 1 |
| 0.28488 | 1 |
| 0.28489 | 1 |
| 0.2849 | 1 |
| 0.28491 | 1 |
| 0.28492 | 1 |
| 0.28493 | 1 |
| 0.28494 | 1 |
| 0.28495 | 1 |
| 0.28496 | 1 |
| 0.28497 | 1 |
| 0.28498 | 1 |
| 0.28499 | 1 |
| 0.285 | 1 |
| 0.28501 | 1 |
| 0.28502 | 1 |
| 0.28503 | 1 |
| 0.28504 | 1 |
| 0.28505 | 1 |
| 0.28506 | 1 |
| 0.28507 | 1 |
| 0.28508 | 1 |
| 0.28509 | 1 |
| 0.2851 | 1 |
| 0.28511 | 1 |
| 0.28512 | 1 |
| 0.28513 | 1 |
| 0.28514 | 1 |
| 0.28515 | 1 |
| 0.28516 | 1 |
| 0.28517 | 1 |
| 0.28518 | 1 |
| 0.28519 | 1 |
| 0.2852 | 1 |
| 0.28521 | 1 |
| 0.28522 | 1 |
| 0.28523 | 1 |
| 0.28524 | 1 |
| 0.28525 | 1 |
| 0.28526 | 1 |
| 0.28527 | 1 |
| 0.28528 | 1 |
| 0.28529 | 1 |
| 0.2853 | 1 |
| 0.28531 | 1 |
| 0.28532 | 1 |
| 0.28533 | 1 |
| 0.28534 | 1 |
| 0.28535 | 1 |
| 0.28536 | 1 |
| 0.28537 | 1 |
| 0.28538 | 1 |
| 0.28539 | 1 |
| 0.2854 | 1 |
| 0.28541 | 1 |
| 0.28542 | 1 |
| 0.28543 | 1 |
| 0.28544 | 1 |
| 0.28545 | 1 |
| 0.28546 | 1 |
| 0.28547 | 1 |
| 0.28548 | 1 |
| 0.28549 | 1 |
| 0.2855 | 1 |
| 0.28551 | 1 |
| 0.28552 | 1 |
| 0.28553 | 1 |
| 0.28554 | 1 |
| 0.28555 | 1 |
| 0.28556 | 1 |
| 0.28557 | 1 |
| 0.28558 | 1 |
| 0.28559 | 1 |
| 0.2856 | 1 |
| 0.28561 | 1 |
| 0.28562 | 1 |
| 0.28563 | 1 |
| 0.28564 | 1 |
| 0.28565 | 1 |
| 0.28566 | 1 |
| 0.28567 | 1 |
| 0.28568 | 1 |
| 0.28569 | 1 |
| 0.2857 | 1 |
| 0.28571 | 1 |
| 0.28572 | 1 |
| 0.28573 | 1 |
| 0.28574 | 1 |
| 0.28575 | 1 |
| 0.28576 | 1 |
| 0.28577 | 1 |
| 0.28578 | 1 |
| 0.28579 | 1 |
| 0.2858 | 1 |
| 0.28581 | 1 |
| 0.28582 | 1 |
| 0.28583 | 1 |
| 0.28584 | 1 |
| 0.28585 | 1 |
| 0.28586 | 1 |
| 0.28587 | 1 |
| 0.28588 | 1 |
| 0.28589 | 1 |
| 0.2859 | 1 |
| 0.28591 | 1 |
| 0.28592 | 1 |
| 0.28593 | 1 |
| 0.28594 | 1 |
| 0.28595 | 1 |
| 0.28596 | 1 |
| 0.28597 | 1 |
| 0.28598 | 1 |
| 0.28599 | 1 |
| 0.286 | 1 |
| 0.28601 | 1 |
| 0.28602 | 1 |
| 0.28603 | 1 |
| 0.28604 | 1 |
| 0.28605 | 1 |
| 0.28606 | 1 |
| 0.28607 | 1 |
| 0.28608 | 1 |
| 0.28609 | 1 |
| 0.2861 | 1 |
| 0.28611 | 1 |
| 0.28612 | 1 |
| 0.28613 | 1 |
| 0.28614 | 1 |
| 0.28615 | 1 |
| 0.28616 | 1 |
| 0.28617 | 1 |
| 0.28618 | 1 |
| 0.28619 | 1 |
| 0.2862 | 1 |
| 0.28621 | 1 |
| 0.28622 | 1 |
| 0.28623 | 1 |
| 0.28624 | 1 |
| 0.28625 | 1 |
| 0.28626 | 1 |
| 0.28627 | 1 |
| 0.28628 | 1 |
| 0.28629 | 1 |
| 0.2863 | 1 |
| 0.28631 | 1 |
| 0.28632 | 1 |
| 0.28633 | 1 |
| 0.28634 | 1 |
| 0.28635 | 1 |
| 0.28636 | 1 |
| 0.28637 | 1 |
| 0.28638 | 1 |
| 0.28639 | 1 |
| 0.2864 | 1 |
| 0.28641 | 1 |
| 0.28642 | 1 |
| 0.28643 | 1 |
| 0.28644 | 1 |
| 0.28645 | 1 |
| 0.28646 | 1 |
| 0.28647 | 1 |
| 0.28648 | 1 |
| 0.28649 | 1 |
| 0.2865 | 1 |
| 0.28651 | 1 |
| 0.28652 | 1 |
| 0.28653 | 1 |
| 0.28654 | 1 |
| 0.28655 | 1 |
| 0.28656 | 1 |
| 0.28657 | 1 |
| 0.28658 | 1 |
| 0.28659 | 1 |
| 0.2866 | 1 |
| 0.28661 | 1 |
| 0.28662 | 1 |
| 0.28663 | 1 |
| 0.28664 | 1 |
| 0.28665 | 1 |
| 0.28666 | 1 |
| 0.28667 | 1 |
| 0.28668 | 1 |
| 0.28669 | 1 |
| 0.2867 | 1 |
| 0.28671 | 1 |
| 0.28672 | 1 |
| 0.28673 | 1 |
| 0.28674 | 1 |
| 0.28675 | 1 |
| 0.28676 | 1 |
| 0.28677 | 1 |
| 0.28678 | 1 |
| 0.28679 | 1 |
| 0.2868 | 1 |
| 0.28681 | 1 |
| 0.28682 | 1 |
| 0.28683 | 1 |
| 0.28684 | 1 |
| 0.28685 | 1 |
| 0.28686 | 1 |
| 0.28687 | 1 |
| 0.28688 | 1 |
| 0.28689 | 1 |
| 0.2869 | 1 |
| 0.28691 | 1 |
| 0.28692 | 1 |
| 0.28693 | 1 |
| 0.28694 | 1 |
| 0.28695 | 1 |
| 0.28696 | 1 |
| 0.28697 | 1 |
| 0.28698 | 1 |
| 0.28699 | 1 |
| 0.287 | 1 |
| 0.28701 | 1 |
| 0.28702 | 1 |
| 0.28703 | 1 |
| 0.28704 | 1 |
| 0.28705 | 1 |
| 0.28706 | 1 |
| 0.28707 | 1 |
| 0.28708 | 1 |
| 0.28709 | 1 |
| 0.2871 | 1 |
| 0.28711 | 1 |
| 0.28712 | 1 |
| 0.28713 | 1 |
| 0.28714 | 1 |
| 0.28715 | 1 |
| 0.28716 | 1 |
| 0.28717 | 1 |
| 0.28718 | 1 |
| 0.28719 | 1 |
| 0.2872 | 1 |
| 0.28721 | 1 |
| 0.28722 | 1 |
| 0.28723 | 1 |
| 0.28724 | 1 |
| 0.28725 | 1 |
| 0.28726 | 1 |
| 0.28727 | 1 |
| 0.28728 | 1 |
| 0.28729 | 1 |
| 0.2873 | 1 |
| 0.28731 | 1 |
| 0.28732 | 1 |
| 0.28733 | 0.999 |
| 0.28734 | 1 |
| 0.28735 | 1 |
| 0.28736 | 1 |
| 0.28737 | 0.999 |
| 0.28738 | 1 |
| 0.28739 | 1 |
| 0.2874 | 1 |
| 0.28741 | 0.999 |
| 0.28742 | 1 |
| 0.28743 | 1 |
| 0.28744 | 1 |
| 0.28745 | 0.999 |
| 0.28746 | 1 |
| 0.28747 | 1 |
| 0.28748 | 1 |
| 0.28749 | 0.999 |
| 0.2875 | 1 |
| 0.28751 | 1 |
| 0.28752 | 1 |
| 0.28753 | 0.999 |
| 0.28754 | 1 |
| 0.28755 | 1 |
| 0.28756 | 1 |
| 0.28757 | 0.999 |
| 0.28758 | 1 |
| 0.28759 | 1 |
| 0.2876 | 1 |
| 0.28761 | 0.999 |
| 0.28762 | 1 |
| 0.28763 | 1 |
| 0.28764 | 1 |
| 0.28765 | 0.999 |
| 0.28766 | 1 |
| 0.28767 | 1 |
| 0.28768 | 1 |
| 0.28769 | 0.999 |
| 0.2877 | 1 |
| 0.28771 | 1 |
| 0.28772 | 1 |
| 0.28773 | 0.999 |
| 0.28774 | 1 |
| 0.28775 | 1 |
| 0.28776 | 1 |
| 0.28777 | 0.999 |
| 0.28778 | 1 |
| 0.28779 | 1 |
| 0.2878 | 1 |
| 0.28781 | 0.999 |
| 0.28782 | 1 |
| 0.28783 | 1 |
| 0.28784 | 1 |
| 0.28785 | 0.999 |
| 0.28786 | 1 |
| 0.28787 | 1 |
| 0.28788 | 1 |
| 0.28789 | 0.999 |
| 0.2879 | 1 |
| 0.28791 | 1 |
| 0.28792 | 1 |
| 0.28793 | 0.999 |
| 0.28794 | 1 |
| 0.28795 | 1 |
| 0.28796 | 1 |
| 0.28797 | 0.999 |
| 0.28798 | 1 |
| 0.28799 | 1 |
| 0.288 | 1 |
| 0.28801 | 0.999 |
| 0.28802 | 1 |
| 0.28803 | 1 |
| 0.28804 | 1 |
| 0.28805 | 0.999 |
| 0.28806 | 1 |
| 0.28807 | 1 |
| 0.28808 | 1 |
| 0.28809 | 0.999 |
| 0.2881 | 1 |
| 0.28811 | 1 |
| 0.28812 | 1 |
| 0.28813 | 0.999 |
| 0.28814 | 1 |
| 0.28815 | 1 |
| 0.28816 | 1 |
| 0.28817 | 0.999 |
| 0.28818 | 1 |
| 0.28819 | 1 |
| 0.2882 | 1 |
| 0.28821 | 0.999 |
| 0.28822 | 1 |
| 0.28823 | 1 |
| 0.28824 | 1 |
| 0.28825 | 0.999 |
| 0.28826 | 1 |
| 0.28827 | 1 |
| 0.28828 | 1 |
| 0.28829 | 0.999 |
| 0.2883 | 1 |
| 0.28831 | 1 |
| 0.28832 | 1 |
| 0.28833 | 0.999 |
| 0.28834 | 1 |
| 0.28835 | 1 |
| 0.28836 | 1 |
| 0.28837 | 0.999 |
| 0.28838 | 1 |
| 0.28839 | 1 |
| 0.2884 | 1 |
| 0.28841 | 0.999 |
| 0.28842 | 1 |
| 0.28843 | 1 |
| 0.28844 | 1 |
| 0.28845 | 0.999 |
| 0.28846 | 1 |
| 0.28847 | 1 |
| 0.28848 | 1 |
| 0.28849 | 0.999 |
| 0.2885 | 1 |
| 0.28851 | 1 |
| 0.28852 | 1 |
| 0.28853 | 0.999 |
| 0.28854 | 1 |
| 0.28855 | 1 |
| 0.28856 | 1 |
| 0.28857 | 0.999 |
| 0.28858 | 1 |
| 0.28859 | 1 |
| 0.2886 | 1 |
| 0.28861 | 0.999 |
| 0.28862 | 1 |
| 0.28863 | 1 |
| 0.28864 | 1 |
| 0.28865 | 0.999 |
| 0.28866 | 1 |
| 0.28867 | 1 |
| 0.28868 | 1 |
| 0.28869 | 0.999 |
| 0.2887 | 1 |
| 0.28871 | 1 |
| 0.28872 | 1 |
| 0.28873 | 0.999 |
| 0.28874 | 1 |
| 0.28875 | 1 |
| 0.28876 | 1 |
| 0.28877 | 0.999 |
| 0.28878 | 1 |
| 0.28879 | 1 |
| 0.2888 | 0.999 |
| 0.28881 | 0.999 |
| 0.28882 | 0.999 |
| 0.28883 | 0.999 |
| 0.28884 | 0.999 |
| 0.28885 | 0.999 |
| 0.28886 | 0.999 |
| 0.28887 | 0.999 |
| 0.28888 | 0.999 |
| 0.28889 | 0.999 |
| 0.2889 | 0.999 |
| 0.28891 | 0.999 |
| 0.28892 | 0.999 |
| 0.28893 | 0.999 |
| 0.28894 | 0.999 |
| 0.28895 | 0.999 |
| 0.28896 | 0.999 |
| 0.28897 | 0.999 |
| 0.28898 | 0.999 |
| 0.28899 | 0.999 |
| 0.289 | 0.999 |
| 0.28901 | 0.999 |
| 0.28902 | 0.999 |
| 0.28903 | 0.999 |
| 0.28904 | 0.999 |
| 0.28905 | 0.999 |
| 0.28906 | 0.999 |
| 0.28907 | 0.999 |
| 0.28908 | 0.999 |
| 0.28909 | 0.999 |
| 0.2891 | 0.999 |
| 0.28911 | 0.999 |
| 0.28912 | 0.999 |
| 0.28913 | 0.999 |
| 0.28914 | 0.999 |
| 0.28915 | 0.999 |
| 0.28916 | 0.999 |
| 0.28917 | 0.999 |
| 0.28918 | 0.999 |
| 0.28919 | 0.999 |
| 0.2892 | 0.999 |
| 0.28921 | 0.999 |
| 0.28922 | 0.999 |
| 0.28923 | 0.999 |
| 0.28924 | 0.999 |
| 0.28925 | 0.999 |
| 0.28926 | 0.999 |
| 0.28927 | 0.999 |
| 0.28928 | 0.999 |
| 0.28929 | 0.999 |
| 0.2893 | 0.999 |
| 0.28931 | 0.999 |
| 0.28932 | 0.999 |
| 0.28933 | 0.999 |
| 0.28934 | 0.999 |
| 0.28935 | 0.999 |
| 0.28936 | 0.999 |
| 0.28937 | 0.999 |
| 0.28938 | 0.999 |
| 0.28939 | 0.999 |
| 0.2894 | 0.999 |
| 0.28941 | 0.999 |
| 0.28942 | 0.999 |
| 0.28943 | 0.999 |
| 0.28944 | 0.999 |
| 0.28945 | 0.999 |
| 0.28946 | 0.999 |
| 0.28947 | 0.999 |
| 0.28948 | 0.999 |
| 0.28949 | 0.999 |
| 0.2895 | 0.999 |
| 0.28951 | 0.999 |
| 0.28952 | 0.999 |
| 0.28953 | 0.999 |
| 0.28954 | 0.999 |
| 0.28955 | 0.999 |
| 0.28956 | 0.999 |
| 0.28957 | 0.999 |
| 0.28958 | 0.999 |
| 0.28959 | 0.999 |
| 0.2896 | 0.999 |
| 0.28961 | 0.999 |
| 0.28962 | 0.999 |
| 0.28963 | 0.999 |
| 0.28964 | 0.999 |
| 0.28965 | 0.999 |
| 0.28966 | 0.999 |
| 0.28967 | 0.999 |
| 0.28968 | 0.999 |
| 0.28969 | 0.999 |
| 0.2897 | 0.999 |
| 0.28971 | 0.999 |
| 0.28972 | 0.999 |
| 0.28973 | 0.999 |
| 0.28974 | 0.999 |
| 0.28975 | 0.999 |
| 0.28976 | 0.999 |
| 0.28977 | 0.999 |
| 0.28978 | 0.999 |
| 0.28979 | 0.999 |
| 0.2898 | 0.999 |
| 0.28981 | 0.999 |
| 0.28982 | 0.999 |
| 0.28983 | 0.999 |
| 0.28984 | 0.999 |
| 0.28985 | 0.999 |
| 0.28986 | 0.999 |
| 0.28987 | 0.999 |
| 0.28988 | 0.999 |
| 0.28989 | 0.999 |
| 0.2899 | 0.999 |
| 0.28991 | 0.999 |
| 0.28992 | 0.999 |
| 0.28993 | 0.999 |
| 0.28994 | 0.999 |
| 0.28995 | 0.999 |
| 0.28996 | 0.999 |
| 0.28997 | 0.999 |
| 0.28998 | 0.999 |
| 0.28999 | 0.999 |
| 0.29 | 0.999 |
| 0.29001 | 0.999 |
| 0.29002 | 0.999 |
| 0.29003 | 0.999 |
| 0.29004 | 0.999 |
| 0.29005 | 0.999 |
| 0.29006 | 0.999 |
| 0.29007 | 0.999 |
| 0.29008 | 0.999 |
| 0.29009 | 0.999 |
| 0.2901 | 0.999 |
| 0.29011 | 0.999 |
| 0.29012 | 0.999 |
| 0.29013 | 0.999 |
| 0.29014 | 0.999 |
| 0.29015 | 0.999 |
| 0.29016 | 0.999 |
| 0.29017 | 0.999 |
| 0.29018 | 0.999 |
| 0.29019 | 0.999 |
| 0.2902 | 0.999 |
| 0.29021 | 0.999 |
| 0.29022 | 0.999 |
| 0.29023 | 0.999 |
| 0.29024 | 0.999 |
| 0.29025 | 0.999 |
| 0.29026 | 0.999 |
| 0.29027 | 0.999 |
| 0.29028 | 0.999 |
| 0.29029 | 0.999 |
| 0.2903 | 0.999 |
| 0.29031 | 0.999 |
| 0.29032 | 0.999 |
| 0.29033 | 0.999 |
| 0.29034 | 0.999 |
| 0.29035 | 0.999 |
| 0.29036 | 0.999 |
| 0.29037 | 0.999 |
| 0.29038 | 0.999 |
| 0.29039 | 0.999 |
| 0.2904 | 0.999 |
| 0.29041 | 0.999 |
| 0.29042 | 0.999 |
| 0.29043 | 0.999 |
| 0.29044 | 0.999 |
| 0.29045 | 0.999 |
| 0.29046 | 0.999 |
| 0.29047 | 0.999 |
| 0.29048 | 0.999 |
| 0.29049 | 0.999 |
| 0.2905 | 0.999 |
| 0.29051 | 0.999 |
| 0.29052 | 0.999 |
| 0.29053 | 0.999 |
| 0.29054 | 0.999 |
| 0.29055 | 0.999 |
| 0.29056 | 0.999 |
| 0.29057 | 0.999 |
| 0.29058 | 0.999 |
| 0.29059 | 0.999 |
| 0.2906 | 0.999 |
| 0.29061 | 0.999 |
| 0.29062 | 0.999 |
| 0.29063 | 0.999 |
| 0.29064 | 0.999 |
| 0.29065 | 0.999 |
| 0.29066 | 0.999 |
| 0.29067 | 0.999 |
| 0.29068 | 0.999 |
| 0.29069 | 0.999 |
| 0.2907 | 0.999 |
| 0.29071 | 0.999 |
| 0.29072 | 0.999 |
| 0.29073 | 0.999 |
| 0.29074 | 0.999 |
| 0.29075 | 0.999 |
| 0.29076 | 0.999 |
| 0.29077 | 0.999 |
| 0.29078 | 0.999 |
| 0.29079 | 0.999 |
| 0.2908 | 0.999 |
| 0.29081 | 0.999 |
| 0.29082 | 0.999 |
| 0.29083 | 0.999 |
| 0.29084 | 0.999 |
| 0.29085 | 0.999 |
| 0.29086 | 0.999 |
| 0.29087 | 0.999 |
| 0.29088 | 0.999 |
| 0.29089 | 0.999 |
| 0.2909 | 0.999 |
| 0.29091 | 0.999 |
| 0.29092 | 0.999 |
| 0.29093 | 0.999 |
| 0.29094 | 0.999 |
| 0.29095 | 0.999 |
| 0.29096 | 0.999 |
| 0.29097 | 0.999 |
| 0.29098 | 0.999 |
| 0.29099 | 0.999 |
| 0.291 | 0.999 |
| 0.29101 | 0.999 |
| 0.29102 | 0.999 |
| 0.29103 | 0.999 |
| 0.29104 | 0.999 |
| 0.29105 | 0.999 |
| 0.29106 | 0.999 |
| 0.29107 | 0.999 |
| 0.29108 | 0.999 |
| 0.29109 | 0.999 |
| 0.2911 | 0.999 |
| 0.29111 | 0.999 |
| 0.29112 | 0.999 |
| 0.29113 | 0.999 |
| 0.29114 | 0.999 |
| 0.29115 | 0.999 |
| 0.29116 | 0.999 |
| 0.29117 | 0.999 |
| 0.29118 | 0.999 |
| 0.29119 | 0.999 |
| 0.2912 | 0.999 |
| 0.29121 | 0.999 |
| 0.29122 | 0.999 |
| 0.29123 | 0.999 |
| 0.29124 | 0.999 |
| 0.29125 | 0.999 |
| 0.29126 | 0.999 |
| 0.29127 | 0.999 |
| 0.29128 | 0.999 |
| 0.29129 | 0.999 |
| 0.2913 | 0.999 |
| 0.29131 | 0.999 |
| 0.29132 | 0.999 |
| 0.29133 | 0.999 |
| 0.29134 | 0.999 |
| 0.29135 | 0.999 |
| 0.29136 | 0.999 |
| 0.29137 | 0.999 |
| 0.29138 | 0.999 |
| 0.29139 | 0.999 |
| 0.2914 | 0.999 |
| 0.29141 | 0.999 |
| 0.29142 | 0.999 |
| 0.29143 | 0.999 |
| 0.29144 | 0.999 |
| 0.29145 | 0.999 |
| 0.29146 | 0.999 |
| 0.29147 | 0.999 |
| 0.29148 | 0.999 |
| 0.29149 | 0.999 |
| 0.2915 | 0.999 |
| 0.29151 | 0.999 |
| 0.29152 | 0.999 |
| 0.29153 | 0.999 |
| 0.29154 | 0.999 |
| 0.29155 | 0.999 |
| 0.29156 | 0.999 |
| 0.29157 | 0.999 |
| 0.29158 | 0.999 |
| 0.29159 | 0.999 |
| 0.2916 | 0.999 |
| 0.29161 | 0.999 |
| 0.29162 | 0.999 |
| 0.29163 | 0.999 |
| 0.29164 | 0.999 |
| 0.29165 | 0.999 |
| 0.29166 | 0.999 |
| 0.29167 | 0.999 |
| 0.29168 | 0.999 |
| 0.29169 | 0.999 |
| 0.2917 | 0.999 |
| 0.29171 | 0.999 |
| 0.29172 | 0.999 |
| 0.29173 | 0.999 |
| 0.29174 | 0.999 |
| 0.29175 | 0.999 |
| 0.29176 | 0.999 |
| 0.29177 | 0.999 |
| 0.29178 | 0.999 |
| 0.29179 | 0.999 |
| 0.2918 | 0.999 |
| 0.29181 | 0.999 |
| 0.29182 | 0.999 |
| 0.29183 | 0.999 |
| 0.29184 | 0.999 |
| 0.29185 | 0.999 |
| 0.29186 | 0.999 |
| 0.29187 | 0.999 |
| 0.29188 | 0.999 |
| 0.29189 | 0.999 |
| 0.2919 | 0.999 |
| 0.29191 | 0.999 |
| 0.29192 | 0.999 |
| 0.29193 | 0.999 |
| 0.29194 | 0.999 |
| 0.29195 | 0.999 |
| 0.29196 | 0.999 |
| 0.29197 | 0.999 |
| 0.29198 | 0.999 |
| 0.29199 | 0.999 |
| 0.292 | 0.999 |
| 0.29201 | 0.999 |
| 0.29202 | 0.999 |
| 0.29203 | 0.999 |
| 0.29204 | 0.999 |
| 0.29205 | 0.999 |
| 0.29206 | 0.999 |
| 0.29207 | 0.999 |
| 0.29208 | 0.999 |
| 0.29209 | 0.999 |
| 0.2921 | 0.999 |
| 0.29211 | 0.999 |
| 0.29212 | 0.999 |
| 0.29213 | 0.999 |
| 0.29214 | 0.999 |
| 0.29215 | 0.999 |
| 0.29216 | 0.999 |
| 0.29217 | 0.999 |
| 0.29218 | 0.999 |
| 0.29219 | 0.999 |
| 0.2922 | 0.999 |
| 0.29221 | 0.999 |
| 0.29222 | 0.999 |
| 0.29223 | 0.999 |
| 0.29224 | 0.999 |
| 0.29225 | 0.999 |
| 0.29226 | 0.999 |
| 0.29227 | 0.999 |
| 0.29228 | 0.999 |
| 0.29229 | 0.999 |
| 0.2923 | 0.999 |
| 0.29231 | 0.999 |
| 0.29232 | 0.999 |
| 0.29233 | 0.999 |
| 0.29234 | 0.999 |
| 0.29235 | 0.999 |
| 0.29236 | 0.999 |
| 0.29237 | 0.999 |
| 0.29238 | 0.999 |
| 0.29239 | 0.999 |
| 0.2924 | 0.999 |
| 0.29241 | 0.999 |
| 0.29242 | 0.999 |
| 0.29243 | 0.999 |
| 0.29244 | 0.999 |
| 0.29245 | 0.999 |
| 0.29246 | 0.999 |
| 0.29247 | 0.999 |
| 0.29248 | 0.999 |
| 0.29249 | 0.999 |
| 0.2925 | 0.999 |
| 0.29251 | 0.999 |
| 0.29252 | 0.999 |
| 0.29253 | 0.999 |
| 0.29254 | 0.999 |
| 0.29255 | 0.999 |
| 0.29256 | 0.999 |
| 0.29257 | 0.999 |
| 0.29258 | 0.999 |
| 0.29259 | 0.999 |
| 0.2926 | 0.999 |
| 0.29261 | 0.999 |
| 0.29262 | 0.999 |
| 0.29263 | 0.999 |
| 0.29264 | 0.999 |
| 0.29265 | 0.999 |
| 0.29266 | 0.999 |
| 0.29267 | 0.999 |
| 0.29268 | 0.999 |
| 0.29269 | 0.999 |
| 0.2927 | 0.999 |
| 0.29271 | 0.999 |
| 0.29272 | 0.999 |
| 0.29273 | 0.999 |
| 0.29274 | 0.999 |
| 0.29275 | 0.999 |
| 0.29276 | 0.999 |
| 0.29277 | 0.999 |
| 0.29278 | 0.999 |
| 0.29279 | 0.999 |
| 0.2928 | 0.999 |
| 0.29281 | 0.999 |
| 0.29282 | 0.999 |
| 0.29283 | 0.999 |
| 0.29284 | 0.999 |
| 0.29285 | 0.999 |
| 0.29286 | 0.999 |
| 0.29287 | 0.999 |
| 0.29288 | 0.999 |
| 0.29289 | 0.999 |
| 0.2929 | 0.999 |
| 0.29291 | 0.999 |
| 0.29292 | 0.999 |
| 0.29293 | 0.999 |
| 0.29294 | 0.999 |
| 0.29295 | 0.999 |
| 0.29296 | 0.999 |
| 0.29297 | 0.999 |
| 0.29298 | 0.999 |
| 0.29299 | 0.999 |
| 0.293 | 0.999 |
| 0.29301 | 0.999 |
| 0.29302 | 0.999 |
| 0.29303 | 0.999 |
| 0.29304 | 0.999 |
| 0.29305 | 0.999 |
| 0.29306 | 0.999 |
| 0.29307 | 0.999 |
| 0.29308 | 0.999 |
| 0.29309 | 0.999 |
| 0.2931 | 0.999 |
| 0.29311 | 0.999 |
| 0.29312 | 0.999 |
| 0.29313 | 0.999 |
| 0.29314 | 0.999 |
| 0.29315 | 0.999 |
| 0.29316 | 0.999 |
| 0.29317 | 0.999 |
| 0.29318 | 0.999 |
| 0.29319 | 0.999 |
| 0.2932 | 0.999 |
| 0.29321 | 0.999 |
| 0.29322 | 0.999 |
| 0.29323 | 0.999 |
| 0.29324 | 0.999 |
| 0.29325 | 0.999 |
| 0.29326 | 0.999 |
| 0.29327 | 0.999 |
| 0.29328 | 0.999 |
| 0.29329 | 0.999 |
| 0.2933 | 0.999 |
| 0.29331 | 0.999 |
| 0.29332 | 0.999 |
| 0.29333 | 0.999 |
| 0.29334 | 0.999 |
| 0.29335 | 0.999 |
| 0.29336 | 0.999 |
| 0.29337 | 0.999 |
| 0.29338 | 0.999 |
| 0.29339 | 0.999 |
| 0.2934 | 0.999 |
| 0.29341 | 0.999 |
| 0.29342 | 0.999 |
| 0.29343 | 0.999 |
| 0.29344 | 0.999 |
| 0.29345 | 0.999 |
| 0.29346 | 0.999 |
| 0.29347 | 0.999 |
| 0.29348 | 0.999 |
| 0.29349 | 0.999 |
| 0.2935 | 0.999 |
| 0.29351 | 0.999 |
| 0.29352 | 0.999 |
| 0.29353 | 0.999 |
| 0.29354 | 0.999 |
| 0.29355 | 0.999 |
| 0.29356 | 0.999 |
| 0.29357 | 0.999 |
| 0.29358 | 0.999 |
| 0.29359 | 0.999 |
| 0.2936 | 0.999 |
| 0.29361 | 0.999 |
| 0.29362 | 0.999 |
| 0.29363 | 0.999 |
| 0.29364 | 0.999 |
| 0.29365 | 0.999 |
| 0.29366 | 0.999 |
| 0.29367 | 0.999 |
| 0.29368 | 0.999 |
| 0.29369 | 0.999 |
| 0.2937 | 0.999 |
| 0.29371 | 0.999 |
| 0.29372 | 0.999 |
| 0.29373 | 0.999 |
| 0.29374 | 0.999 |
| 0.29375 | 0.999 |
| 0.29376 | 0.999 |
| 0.29377 | 0.999 |
| 0.29378 | 0.999 |
| 0.29379 | 0.999 |
| 0.2938 | 0.999 |
| 0.29381 | 0.999 |
| 0.29382 | 0.999 |
| 0.29383 | 0.999 |
| 0.29384 | 0.999 |
| 0.29385 | 0.999 |
| 0.29386 | 0.999 |
| 0.29387 | 0.999 |
| 0.29388 | 0.999 |
| 0.29389 | 0.999 |
| 0.2939 | 0.999 |
| 0.29391 | 0.999 |
| 0.29392 | 0.999 |
| 0.29393 | 0.999 |
| 0.29394 | 0.999 |
| 0.29395 | 0.999 |
| 0.29396 | 0.999 |
| 0.29397 | 0.999 |
| 0.29398 | 0.999 |
| 0.29399 | 0.999 |
| 0.294 | 0.999 |
| 0.29401 | 0.999 |
| 0.29402 | 0.999 |
| 0.29403 | 0.999 |
| 0.29404 | 0.999 |
| 0.29405 | 0.999 |
| 0.29406 | 0.999 |
| 0.29407 | 0.999 |
| 0.29408 | 0.999 |
| 0.29409 | 0.999 |
| 0.2941 | 0.999 |
| 0.29411 | 0.999 |
| 0.29412 | 0.999 |
| 0.29413 | 0.999 |
| 0.29414 | 0.999 |
| 0.29415 | 0.999 |
| 0.29416 | 0.999 |
| 0.29417 | 0.999 |
| 0.29418 | 0.999 |
| 0.29419 | 0.999 |
| 0.2942 | 0.999 |
| 0.29421 | 0.999 |
| 0.29422 | 0.999 |
| 0.29423 | 0.999 |
| 0.29424 | 0.999 |
| 0.29425 | 0.999 |
| 0.29426 | 0.999 |
| 0.29427 | 0.999 |
| 0.29428 | 0.999 |
| 0.29429 | 0.999 |
| 0.2943 | 0.999 |
| 0.29431 | 0.999 |
| 0.29432 | 0.999 |
| 0.29433 | 0.999 |
| 0.29434 | 0.999 |
| 0.29435 | 0.999 |
| 0.29436 | 0.999 |
| 0.29437 | 0.999 |
| 0.29438 | 0.999 |
| 0.29439 | 0.999 |
| 0.2944 | 0.999 |
| 0.29441 | 0.999 |
| 0.29442 | 0.999 |
| 0.29443 | 0.999 |
| 0.29444 | 0.999 |
| 0.29445 | 0.999 |
| 0.29446 | 0.999 |
| 0.29447 | 0.999 |
| 0.29448 | 0.999 |
| 0.29449 | 0.999 |
| 0.2945 | 0.999 |
| 0.29451 | 0.999 |
| 0.29452 | 0.999 |
| 0.29453 | 0.999 |
| 0.29454 | 0.999 |
| 0.29455 | 0.999 |
| 0.29456 | 0.999 |
| 0.29457 | 0.999 |
| 0.29458 | 0.999 |
| 0.29459 | 0.999 |
| 0.2946 | 0.999 |
| 0.29461 | 0.999 |
| 0.29462 | 0.999 |
| 0.29463 | 0.999 |
| 0.29464 | 0.999 |
| 0.29465 | 0.999 |
| 0.29466 | 0.999 |
| 0.29467 | 0.999 |
| 0.29468 | 0.999 |
| 0.29469 | 0.999 |
| 0.2947 | 0.999 |
| 0.29471 | 0.999 |
| 0.29472 | 0.999 |
| 0.29473 | 0.999 |
| 0.29474 | 0.999 |
| 0.29475 | 0.999 |
| 0.29476 | 0.999 |
| 0.29477 | 0.999 |
| 0.29478 | 0.999 |
| 0.29479 | 0.999 |
| 0.2948 | 0.999 |
| 0.29481 | 0.999 |
| 0.29482 | 0.999 |
| 0.29483 | 0.999 |
| 0.29484 | 0.999 |
| 0.29485 | 0.999 |
| 0.29486 | 0.999 |
| 0.29487 | 0.999 |
| 0.29488 | 0.999 |
| 0.29489 | 0.999 |
| 0.2949 | 0.999 |
| 0.29491 | 0.999 |
| 0.29492 | 0.999 |
| 0.29493 | 0.999 |
| 0.29494 | 0.999 |
| 0.29495 | 0.999 |
| 0.29496 | 0.999 |
| 0.29497 | 0.999 |
| 0.29498 | 0.999 |
| 0.29499 | 0.999 |
| 0.295 | 0.999 |
| 0.29501 | 0.999 |
| 0.29502 | 0.999 |
| 0.29503 | 0.999 |
| 0.29504 | 0.999 |
| 0.29505 | 0.999 |
| 0.29506 | 0.999 |
| 0.29507 | 0.999 |
| 0.29508 | 0.999 |
| 0.29509 | 0.999 |
| 0.2951 | 0.999 |
| 0.29511 | 0.999 |
| 0.29512 | 0.999 |
| 0.29513 | 0.999 |
| 0.29514 | 0.999 |
| 0.29515 | 0.999 |
| 0.29516 | 0.999 |
| 0.29517 | 0.999 |
| 0.29518 | 0.999 |
| 0.29519 | 0.999 |
| 0.2952 | 0.999 |
| 0.29521 | 0.999 |
| 0.29522 | 0.999 |
| 0.29523 | 0.999 |
| 0.29524 | 0.999 |
| 0.29525 | 0.999 |
| 0.29526 | 0.999 |
| 0.29527 | 0.999 |
| 0.29528 | 0.999 |
| 0.29529 | 0.999 |
| 0.2953 | 0.999 |
| 0.29531 | 0.999 |
| 0.29532 | 0.999 |
| 0.29533 | 0.999 |
| 0.29534 | 0.999 |
| 0.29535 | 0.999 |
| 0.29536 | 0.999 |
| 0.29537 | 0.999 |
| 0.29538 | 0.999 |
| 0.29539 | 0.999 |
| 0.2954 | 0.999 |
| 0.29541 | 0.999 |
| 0.29542 | 0.999 |
| 0.29543 | 0.999 |
| 0.29544 | 0.999 |
| 0.29545 | 0.999 |
| 0.29546 | 0.999 |
| 0.29547 | 0.999 |
| 0.29548 | 0.999 |
| 0.29549 | 0.999 |
| 0.2955 | 0.999 |
| 0.29551 | 0.999 |
| 0.29552 | 0.999 |
| 0.29553 | 0.999 |
| 0.29554 | 0.999 |
| 0.29555 | 0.999 |
| 0.29556 | 0.999 |
| 0.29557 | 0.999 |
| 0.29558 | 0.999 |
| 0.29559 | 0.999 |
| 0.2956 | 0.999 |
| 0.29561 | 0.999 |
| 0.29562 | 0.999 |
| 0.29563 | 0.999 |
| 0.29564 | 0.999 |
| 0.29565 | 0.999 |
| 0.29566 | 0.999 |
| 0.29567 | 0.999 |
| 0.29568 | 0.999 |
| 0.29569 | 0.999 |
| 0.2957 | 0.999 |
| 0.29571 | 0.999 |
| 0.29572 | 0.999 |
| 0.29573 | 0.999 |
| 0.29574 | 0.999 |
| 0.29575 | 0.999 |
| 0.29576 | 0.999 |
| 0.29577 | 0.999 |
| 0.29578 | 0.999 |
| 0.29579 | 0.999 |
| 0.2958 | 0.999 |
| 0.29581 | 0.999 |
| 0.29582 | 0.999 |
| 0.29583 | 0.999 |
| 0.29584 | 0.999 |
| 0.29585 | 0.999 |
| 0.29586 | 0.999 |
| 0.29587 | 0.999 |
| 0.29588 | 0.999 |
| 0.29589 | 0.999 |
| 0.2959 | 0.999 |
| 0.29591 | 0.999 |
| 0.29592 | 0.999 |
| 0.29593 | 0.999 |
| 0.29594 | 0.999 |
| 0.29595 | 0.999 |
| 0.29596 | 0.999 |
| 0.29597 | 0.999 |
| 0.29598 | 0.999 |
| 0.29599 | 0.999 |
| 0.296 | 0.999 |
| 0.29601 | 0.999 |
| 0.29602 | 0.999 |
| 0.29603 | 0.999 |
| 0.29604 | 0.999 |
| 0.29605 | 0.999 |
| 0.29606 | 0.999 |
| 0.29607 | 0.999 |
| 0.29608 | 0.999 |
| 0.29609 | 0.999 |
| 0.2961 | 0.999 |
| 0.29611 | 0.999 |
| 0.29612 | 0.999 |
| 0.29613 | 0.999 |
| 0.29614 | 0.999 |
| 0.29615 | 0.999 |
| 0.29616 | 0.999 |
| 0.29617 | 0.999 |
| 0.29618 | 0.999 |
| 0.29619 | 0.999 |
| 0.2962 | 0.999 |
| 0.29621 | 0.999 |
| 0.29622 | 0.999 |
| 0.29623 | 0.999 |
| 0.29624 | 0.999 |
| 0.29625 | 0.999 |
| 0.29626 | 0.999 |
| 0.29627 | 0.999 |
| 0.29628 | 0.999 |
| 0.29629 | 0.999 |
| 0.2963 | 0.999 |
| 0.29631 | 0.999 |
| 0.29632 | 0.999 |
| 0.29633 | 0.999 |
| 0.29634 | 0.999 |
| 0.29635 | 0.999 |
| 0.29636 | 0.999 |
| 0.29637 | 0.999 |
| 0.29638 | 0.999 |
| 0.29639 | 0.999 |
| 0.2964 | 0.999 |
| 0.29641 | 0.999 |
| 0.29642 | 0.999 |
| 0.29643 | 0.999 |
| 0.29644 | 0.999 |
| 0.29645 | 0.999 |
| 0.29646 | 0.999 |
| 0.29647 | 0.999 |
| 0.29648 | 0.999 |
| 0.29649 | 0.999 |
| 0.2965 | 0.999 |
| 0.29651 | 0.999 |
| 0.29652 | 0.999 |
| 0.29653 | 0.999 |
| 0.29654 | 0.999 |
| 0.29655 | 0.999 |
| 0.29656 | 0.999 |
| 0.29657 | 0.999 |
| 0.29658 | 0.999 |
| 0.29659 | 0.999 |
| 0.2966 | 0.999 |
| 0.29661 | 0.999 |
| 0.29662 | 0.999 |
| 0.29663 | 0.999 |
| 0.29664 | 0.999 |
| 0.29665 | 0.999 |
| 0.29666 | 0.999 |
| 0.29667 | 0.999 |
| 0.29668 | 0.999 |
| 0.29669 | 0.999 |
| 0.2967 | 0.999 |
| 0.29671 | 0.999 |
| 0.29672 | 0.999 |
| 0.29673 | 0.999 |
| 0.29674 | 0.999 |
| 0.29675 | 0.999 |
| 0.29676 | 0.999 |
| 0.29677 | 0.999 |
| 0.29678 | 0.999 |
| 0.29679 | 0.999 |
| 0.2968 | 0.999 |
| 0.29681 | 0.999 |
| 0.29682 | 0.999 |
| 0.29683 | 0.999 |
| 0.29684 | 0.999 |
| 0.29685 | 0.999 |
| 0.29686 | 0.999 |
| 0.29687 | 0.999 |
| 0.29688 | 0.999 |
| 0.29689 | 0.999 |
| 0.2969 | 0.999 |
| 0.29691 | 0.999 |
| 0.29692 | 0.999 |
| 0.29693 | 0.999 |
| 0.29694 | 0.999 |
| 0.29695 | 0.999 |
| 0.29696 | 0.999 |
| 0.29697 | 0.999 |
| 0.29698 | 0.999 |
| 0.29699 | 0.999 |
| 0.297 | 0.999 |
| 0.29701 | 0.999 |
| 0.29702 | 0.999 |
| 0.29703 | 0.999 |
| 0.29704 | 0.999 |
| 0.29705 | 0.999 |
| 0.29706 | 0.999 |
| 0.29707 | 0.999 |
| 0.29708 | 0.999 |
| 0.29709 | 0.999 |
| 0.2971 | 0.999 |
| 0.29711 | 0.999 |
| 0.29712 | 0.999 |
| 0.29713 | 0.999 |
| 0.29714 | 0.999 |
| 0.29715 | 0.999 |
| 0.29716 | 0.999 |
| 0.29717 | 0.999 |
| 0.29718 | 0.999 |
| 0.29719 | 0.999 |
| 0.2972 | 0.999 |
| 0.29721 | 0.999 |
| 0.29722 | 0.999 |
| 0.29723 | 0.999 |
| 0.29724 | 0.999 |
| 0.29725 | 0.999 |
| 0.29726 | 0.999 |
| 0.29727 | 0.999 |
| 0.29728 | 0.999 |
| 0.29729 | 0.999 |
| 0.2973 | 0.999 |
| 0.29731 | 0.999 |
| 0.29732 | 0.999 |
| 0.29733 | 0.999 |
| 0.29734 | 0.999 |
| 0.29735 | 0.999 |
| 0.29736 | 0.999 |
| 0.29737 | 0.999 |
| 0.29738 | 0.999 |
| 0.29739 | 0.999 |
| 0.2974 | 0.999 |
| 0.29741 | 0.999 |
| 0.29742 | 0.999 |
| 0.29743 | 0.999 |
| 0.29744 | 0.999 |
| 0.29745 | 0.999 |
| 0.29746 | 0.999 |
| 0.29747 | 0.999 |
| 0.29748 | 0.999 |
| 0.29749 | 0.999 |
| 0.2975 | 0.999 |
| 0.29751 | 0.999 |
| 0.29752 | 0.999 |
| 0.29753 | 0.999 |
| 0.29754 | 0.999 |
| 0.29755 | 0.999 |
| 0.29756 | 0.999 |
| 0.29757 | 0.999 |
| 0.29758 | 0.999 |
| 0.29759 | 0.999 |
| 0.2976 | 0.999 |
| 0.29761 | 0.999 |
| 0.29762 | 0.999 |
| 0.29763 | 0.999 |
| 0.29764 | 0.999 |
| 0.29765 | 0.999 |
| 0.29766 | 0.999 |
| 0.29767 | 0.999 |
| 0.29768 | 0.999 |
| 0.29769 | 0.999 |
| 0.2977 | 0.999 |
| 0.29771 | 0.999 |
| 0.29772 | 0.999 |
| 0.29773 | 0.999 |
| 0.29774 | 0.999 |
| 0.29775 | 0.999 |
| 0.29776 | 0.999 |
| 0.29777 | 0.999 |
| 0.29778 | 0.999 |
| 0.29779 | 0.999 |
| 0.2978 | 0.999 |
| 0.29781 | 0.999 |
| 0.29782 | 0.999 |
| 0.29783 | 0.999 |
| 0.29784 | 0.999 |
| 0.29785 | 0.999 |
| 0.29786 | 0.999 |
| 0.29787 | 0.999 |
| 0.29788 | 0.999 |
| 0.29789 | 0.999 |
| 0.2979 | 0.999 |
| 0.29791 | 0.999 |
| 0.29792 | 0.999 |
| 0.29793 | 0.999 |
| 0.29794 | 0.999 |
| 0.29795 | 0.999 |
| 0.29796 | 0.999 |
| 0.29797 | 0.999 |
| 0.29798 | 0.999 |
| 0.29799 | 0.999 |
| 0.298 | 0.999 |
| 0.29801 | 0.999 |
| 0.29802 | 0.999 |
| 0.29803 | 0.999 |
| 0.29804 | 0.999 |
| 0.29805 | 0.999 |
| 0.29806 | 0.999 |
| 0.29807 | 0.999 |
| 0.29808 | 0.999 |
| 0.29809 | 0.999 |
| 0.2981 | 0.999 |
| 0.29811 | 0.999 |
| 0.29812 | 0.999 |
| 0.29813 | 0.999 |
| 0.29814 | 0.999 |
| 0.29815 | 0.999 |
| 0.29816 | 0.999 |
| 0.29817 | 0.999 |
| 0.29818 | 0.999 |
| 0.29819 | 0.999 |
| 0.2982 | 0.999 |
| 0.29821 | 0.999 |
| 0.29822 | 0.999 |
| 0.29823 | 0.999 |
| 0.29824 | 0.999 |
| 0.29825 | 0.999 |
| 0.29826 | 0.999 |
| 0.29827 | 0.999 |
| 0.29828 | 0.999 |
| 0.29829 | 0.999 |
| 0.2983 | 0.999 |
| 0.29831 | 0.999 |
| 0.29832 | 0.999 |
| 0.29833 | 0.999 |
| 0.29834 | 0.999 |
| 0.29835 | 0.999 |
| 0.29836 | 0.999 |
| 0.29837 | 0.999 |
| 0.29838 | 0.999 |
| 0.29839 | 0.999 |
| 0.2984 | 0.999 |
| 0.29841 | 0.999 |
| 0.29842 | 0.999 |
| 0.29843 | 0.999 |
| 0.29844 | 0.999 |
| 0.29845 | 0.999 |
| 0.29846 | 0.999 |
| 0.29847 | 0.999 |
| 0.29848 | 0.999 |
| 0.29849 | 0.999 |
| 0.2985 | 0.999 |
| 0.29851 | 0.999 |
| 0.29852 | 0.999 |
| 0.29853 | 0.999 |
| 0.29854 | 0.999 |
| 0.29855 | 0.999 |
| 0.29856 | 0.999 |
| 0.29857 | 0.999 |
| 0.29858 | 0.999 |
| 0.29859 | 0.999 |
| 0.2986 | 0.999 |
| 0.29861 | 0.999 |
| 0.29862 | 0.999 |
| 0.29863 | 0.999 |
| 0.29864 | 0.999 |
| 0.29865 | 0.999 |
| 0.29866 | 0.999 |
| 0.29867 | 0.999 |
| 0.29868 | 0.999 |
| 0.29869 | 0.999 |
| 0.2987 | 0.999 |
| 0.29871 | 0.999 |
| 0.29872 | 0.999 |
| 0.29873 | 0.999 |
| 0.29874 | 0.999 |
| 0.29875 | 0.999 |
| 0.29876 | 0.999 |
| 0.29877 | 0.999 |
| 0.29878 | 0.999 |
| 0.29879 | 0.999 |
| 0.2988 | 0.999 |
| 0.29881 | 0.999 |
| 0.29882 | 0.999 |
| 0.29883 | 0.999 |
| 0.29884 | 0.999 |
| 0.29885 | 0.999 |
| 0.29886 | 0.999 |
| 0.29887 | 0.999 |
| 0.29888 | 0.999 |
| 0.29889 | 0.999 |
| 0.2989 | 0.999 |
| 0.29891 | 0.999 |
| 0.29892 | 0.999 |
| 0.29893 | 0.999 |
| 0.29894 | 0.999 |
| 0.29895 | 0.999 |
| 0.29896 | 0.999 |
| 0.29897 | 0.999 |
| 0.29898 | 0.999 |
| 0.29899 | 0.999 |
| 0.299 | 0.999 |
| 0.29901 | 0.999 |
| 0.29902 | 0.999 |
| 0.29903 | 0.999 |
| 0.29904 | 0.999 |
| 0.29905 | 0.999 |
| 0.29906 | 0.999 |
| 0.29907 | 0.999 |
| 0.29908 | 0.999 |
| 0.29909 | 0.999 |
| 0.2991 | 0.999 |
| 0.29911 | 0.999 |
| 0.29912 | 0.999 |
| 0.29913 | 0.999 |
| 0.29914 | 0.999 |
| 0.29915 | 0.999 |
| 0.29916 | 0.999 |
| 0.29917 | 0.999 |
| 0.29918 | 0.999 |
| 0.29919 | 0.999 |
| 0.2992 | 0.999 |
| 0.29921 | 0.999 |
| 0.29922 | 0.999 |
| 0.29923 | 0.999 |
| 0.29924 | 0.999 |
| 0.29925 | 0.999 |
| 0.29926 | 0.999 |
| 0.29927 | 0.999 |
| 0.29928 | 0.999 |
| 0.29929 | 0.999 |
| 0.2993 | 0.999 |
| 0.29931 | 0.999 |
| 0.29932 | 0.999 |
| 0.29933 | 0.999 |
| 0.29934 | 0.999 |
| 0.29935 | 0.999 |
| 0.29936 | 0.999 |
| 0.29937 | 0.999 |
| 0.29938 | 0.999 |
| 0.29939 | 0.999 |
| 0.2994 | 0.999 |
| 0.29941 | 0.999 |
| 0.29942 | 0.999 |
| 0.29943 | 0.999 |
| 0.29944 | 0.999 |
| 0.29945 | 0.999 |
| 0.29946 | 0.999 |
| 0.29947 | 0.999 |
| 0.29948 | 0.999 |
| 0.29949 | 0.999 |
| 0.2995 | 0.999 |
| 0.29951 | 0.999 |
| 0.29952 | 0.999 |
| 0.29953 | 0.999 |
| 0.29954 | 0.999 |
| 0.29955 | 0.999 |
| 0.29956 | 0.999 |
| 0.29957 | 0.999 |
| 0.29958 | 0.999 |
| 0.29959 | 0.999 |
| 0.2996 | 0.999 |
| 0.29961 | 0.999 |
| 0.29962 | 0.999 |
| 0.29963 | 0.999 |
| 0.29964 | 0.999 |
| 0.29965 | 0.999 |
| 0.29966 | 0.999 |
| 0.29967 | 0.999 |
| 0.29968 | 0.999 |
| 0.29969 | 0.999 |
| 0.2997 | 0.999 |
| 0.29971 | 0.999 |
| 0.29972 | 0.999 |
| 0.29973 | 0.999 |
| 0.29974 | 0.999 |
| 0.29975 | 0.999 |
| 0.29976 | 0.999 |
| 0.29977 | 0.999 |
| 0.29978 | 0.999 |
| 0.29979 | 0.999 |
| 0.2998 | 0.999 |
| 0.29981 | 0.999 |
| 0.29982 | 0.999 |
| 0.29983 | 0.999 |
| 0.29984 | 0.999 |
| 0.29985 | 0.999 |
| 0.29986 | 0.999 |
| 0.29987 | 0.999 |
| 0.29988 | 0.999 |
| 0.29989 | 0.999 |
| 0.2999 | 0.999 |
| 0.29991 | 0.999 |
| 0.29992 | 0.999 |
| 0.29993 | 0.999 |
| 0.29994 | 0.999 |
| 0.29995 | 0.999 |
| 0.29996 | 0.999 |
| 0.29997 | 0.999 |
| 0.29998 | 0.999 |
| 0.29999 | 0.999 |
| 0.3 | 0.999 |